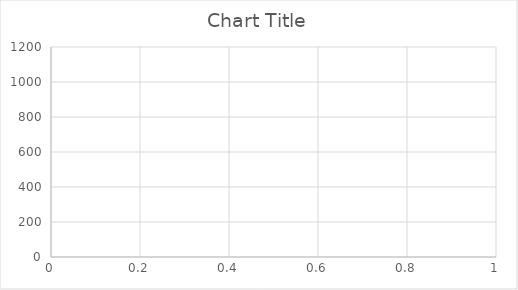
| Category | Series 0 |
|---|---|
| 0 | 1023 |
| 1 | 1023 |
| 2 | 1023 |
| 3 | 1023 |
| 4 | 1023 |
| 5 | 1023 |
| 6 | 1023 |
| 7 | 1023 |
| 8 | 1023 |
| 9 | 1023 |
| 10 | 1023 |
| 11 | 1023 |
| 12 | 1023 |
| 13 | 0 |
| 14 | 0 |
| 15 | 0 |
| 16 | 0 |
| 17 | 0 |
| 18 | 0 |
| 19 | 0 |
| 20 | 0 |
| 21 | 0 |
| 22 | 0 |
| 23 | 0 |
| 24 | 0 |
| 25 | 0 |
| 26 | 0 |
| 27 | 1023 |
| 28 | 1023 |
| 29 | 1023 |
| 30 | 1023 |
| 31 | 1023 |
| 32 | 1023 |
| 33 | 1023 |
| 34 | 1023 |
| 35 | 1023 |
| 36 | 1023 |
| 37 | 1023 |
| 38 | 1023 |
| 39 | 1023 |
| 40 | 1023 |
| 41 | 1023 |
| 42 | 1023 |
| 43 | 1023 |
| 44 | 1023 |
| 45 | 1023 |
| 46 | 1023 |
| 47 | 1023 |
| 48 | 1023 |
| 49 | 1023 |
| 50 | 1023 |
| 51 | 1023 |
| 52 | 1023 |
| 53 | 1023 |
| 54 | 1023 |
| 55 | 1023 |
| 56 | 1023 |
| 57 | 1023 |
| 58 | 1023 |
| 59 | 1023 |
| 60 | 1023 |
| 61 | 1023 |
| 62 | 1023 |
| 63 | 1023 |
| 64 | 1023 |
| 65 | 1023 |
| 66 | 1023 |
| 67 | 1023 |
| 68 | 0 |
| 69 | 0 |
| 70 | 0 |
| 71 | 0 |
| 72 | 0 |
| 73 | 0 |
| 74 | 0 |
| 75 | 0 |
| 76 | 1 |
| 77 | 0 |
| 78 | 0 |
| 79 | 0 |
| 80 | 0 |
| 81 | 0 |
| 82 | 0 |
| 83 | 1023 |
| 84 | 1023 |
| 85 | 1023 |
| 86 | 1023 |
| 87 | 1023 |
| 88 | 1023 |
| 89 | 1023 |
| 90 | 1023 |
| 91 | 1023 |
| 92 | 1023 |
| 93 | 1023 |
| 94 | 1023 |
| 95 | 1023 |
| 96 | 1023 |
| 97 | 1023 |
| 98 | 1023 |
| 99 | 1023 |
| 100 | 1023 |
| 101 | 1023 |
| 102 | 1023 |
| 103 | 1023 |
| 104 | 1023 |
| 105 | 1023 |
| 106 | 1023 |
| 107 | 1023 |
| 108 | 1023 |
| 109 | 1023 |
| 110 | 1023 |
| 111 | 1023 |
| 112 | 1023 |
| 113 | 1023 |
| 114 | 1023 |
| 115 | 1023 |
| 116 | 1023 |
| 117 | 1023 |
| 118 | 1023 |
| 119 | 1023 |
| 120 | 1023 |
| 121 | 1023 |
| 122 | 1023 |
| 123 | 1023 |
| 124 | 0 |
| 125 | 0 |
| 126 | 0 |
| 127 | 0 |
| 128 | 0 |
| 129 | 0 |
| 130 | 0 |
| 131 | 0 |
| 132 | 0 |
| 133 | 0 |
| 134 | 0 |
| 135 | 0 |
| 136 | 0 |
| 137 | 0 |
| 138 | 1023 |
| 139 | 1023 |
| 140 | 1023 |
| 141 | 1023 |
| 142 | 1023 |
| 143 | 1023 |
| 144 | 1023 |
| 145 | 1023 |
| 146 | 1023 |
| 147 | 1023 |
| 148 | 1023 |
| 149 | 1023 |
| 150 | 1023 |
| 151 | 1023 |
| 152 | 1023 |
| 153 | 1023 |
| 154 | 1023 |
| 155 | 1023 |
| 156 | 1023 |
| 157 | 1023 |
| 158 | 1023 |
| 159 | 1023 |
| 160 | 1023 |
| 161 | 1023 |
| 162 | 1023 |
| 163 | 1023 |
| 164 | 1023 |
| 165 | 1023 |
| 166 | 1023 |
| 167 | 1023 |
| 168 | 1023 |
| 169 | 1023 |
| 170 | 1023 |
| 171 | 1023 |
| 172 | 1023 |
| 173 | 1023 |
| 174 | 1023 |
| 175 | 1023 |
| 176 | 1023 |
| 177 | 0 |
| 178 | 0 |
| 179 | 0 |
| 180 | 0 |
| 181 | 0 |
| 182 | 0 |
| 183 | 0 |
| 184 | 0 |
| 185 | 0 |
| 186 | 0 |
| 187 | 0 |
| 188 | 0 |
| 189 | 0 |
| 190 | 1023 |
| 191 | 1023 |
| 192 | 1023 |
| 193 | 1023 |
| 194 | 1023 |
| 195 | 1023 |
| 196 | 1023 |
| 197 | 1023 |
| 198 | 1023 |
| 199 | 1023 |
| 200 | 1023 |
| 201 | 1023 |
| 202 | 1023 |
| 203 | 1023 |
| 204 | 1023 |
| 205 | 1023 |
| 206 | 1023 |
| 207 | 1023 |
| 208 | 1023 |
| 209 | 1023 |
| 210 | 1023 |
| 211 | 1023 |
| 212 | 1023 |
| 213 | 1023 |
| 214 | 1023 |
| 215 | 1023 |
| 216 | 1023 |
| 217 | 1023 |
| 218 | 1023 |
| 219 | 1023 |
| 220 | 1023 |
| 221 | 1023 |
| 222 | 1023 |
| 223 | 1023 |
| 224 | 1023 |
| 225 | 1023 |
| 226 | 1023 |
| 227 | 1023 |
| 228 | 0 |
| 229 | 0 |
| 230 | 0 |
| 231 | 0 |
| 232 | 0 |
| 233 | 0 |
| 234 | 0 |
| 235 | 0 |
| 236 | 0 |
| 237 | 0 |
| 238 | 0 |
| 239 | 0 |
| 240 | 0 |
| 241 | 1023 |
| 242 | 1023 |
| 243 | 1023 |
| 244 | 1023 |
| 245 | 1023 |
| 246 | 1023 |
| 247 | 1023 |
| 248 | 1023 |
| 249 | 1023 |
| 250 | 1023 |
| 251 | 1023 |
| 252 | 1023 |
| 253 | 1023 |
| 254 | 1023 |
| 255 | 1023 |
| 256 | 1023 |
| 257 | 1023 |
| 258 | 1023 |
| 259 | 1023 |
| 260 | 1023 |
| 261 | 1023 |
| 262 | 1023 |
| 263 | 1023 |
| 264 | 1023 |
| 265 | 1023 |
| 266 | 1023 |
| 267 | 1023 |
| 268 | 1023 |
| 269 | 1023 |
| 270 | 1023 |
| 271 | 1023 |
| 272 | 1023 |
| 273 | 1023 |
| 274 | 1023 |
| 275 | 1023 |
| 276 | 1023 |
| 277 | 1023 |
| 278 | 1023 |
| 279 | 0 |
| 280 | 0 |
| 281 | 0 |
| 282 | 0 |
| 283 | 0 |
| 284 | 0 |
| 285 | 0 |
| 286 | 0 |
| 287 | 0 |
| 288 | 0 |
| 289 | 0 |
| 290 | 0 |
| 291 | 0 |
| 292 | 1023 |
| 293 | 1023 |
| 294 | 1023 |
| 295 | 1023 |
| 296 | 1023 |
| 297 | 1023 |
| 298 | 1023 |
| 299 | 1023 |
| 300 | 1023 |
| 301 | 1023 |
| 302 | 1023 |
| 303 | 1023 |
| 304 | 1023 |
| 305 | 1023 |
| 306 | 1023 |
| 307 | 1023 |
| 308 | 1023 |
| 309 | 1023 |
| 310 | 1023 |
| 311 | 1023 |
| 312 | 1023 |
| 313 | 1023 |
| 314 | 1023 |
| 315 | 1023 |
| 316 | 1023 |
| 317 | 1023 |
| 318 | 1023 |
| 319 | 1023 |
| 320 | 1023 |
| 321 | 1023 |
| 322 | 1023 |
| 323 | 1023 |
| 324 | 1023 |
| 325 | 1023 |
| 326 | 1023 |
| 327 | 1023 |
| 328 | 1023 |
| 329 | 1023 |
| 330 | 0 |
| 331 | 0 |
| 332 | 0 |
| 333 | 0 |
| 334 | 0 |
| 335 | 0 |
| 336 | 0 |
| 337 | 0 |
| 338 | 0 |
| 339 | 0 |
| 340 | 0 |
| 341 | 0 |
| 342 | 0 |
| 343 | 1023 |
| 344 | 1023 |
| 345 | 1023 |
| 346 | 1023 |
| 347 | 1023 |
| 348 | 1023 |
| 349 | 1023 |
| 350 | 1023 |
| 351 | 1023 |
| 352 | 1023 |
| 353 | 1023 |
| 354 | 1023 |
| 355 | 1023 |
| 356 | 1023 |
| 357 | 1023 |
| 358 | 1023 |
| 359 | 1023 |
| 360 | 1023 |
| 361 | 1023 |
| 362 | 1023 |
| 363 | 1023 |
| 364 | 1023 |
| 365 | 1023 |
| 366 | 1023 |
| 367 | 1023 |
| 368 | 1023 |
| 369 | 1023 |
| 370 | 1023 |
| 371 | 1023 |
| 372 | 1023 |
| 373 | 1023 |
| 374 | 1023 |
| 375 | 1023 |
| 376 | 1023 |
| 377 | 1023 |
| 378 | 1023 |
| 379 | 1023 |
| 380 | 1023 |
| 381 | 0 |
| 382 | 0 |
| 383 | 0 |
| 384 | 0 |
| 385 | 0 |
| 386 | 0 |
| 387 | 0 |
| 388 | 0 |
| 389 | 0 |
| 390 | 0 |
| 391 | 0 |
| 392 | 0 |
| 393 | 0 |
| 394 | 1023 |
| 395 | 1023 |
| 396 | 1023 |
| 397 | 1023 |
| 398 | 1023 |
| 399 | 1023 |
| 400 | 1023 |
| 401 | 1023 |
| 402 | 1023 |
| 403 | 1023 |
| 404 | 1023 |
| 405 | 1023 |
| 406 | 1023 |
| 407 | 1023 |
| 408 | 1023 |
| 409 | 1023 |
| 410 | 1023 |
| 411 | 1023 |
| 412 | 1023 |
| 413 | 1023 |
| 414 | 1023 |
| 415 | 1023 |
| 416 | 1023 |
| 417 | 1023 |
| 418 | 1023 |
| 419 | 1023 |
| 420 | 1023 |
| 421 | 1023 |
| 422 | 1023 |
| 423 | 1023 |
| 424 | 1023 |
| 425 | 1023 |
| 426 | 1023 |
| 427 | 1023 |
| 428 | 1023 |
| 429 | 1023 |
| 430 | 1023 |
| 431 | 1023 |
| 432 | 0 |
| 433 | 0 |
| 434 | 0 |
| 435 | 0 |
| 436 | 0 |
| 437 | 0 |
| 438 | 0 |
| 439 | 0 |
| 440 | 0 |
| 441 | 0 |
| 442 | 0 |
| 443 | 0 |
| 444 | 0 |
| 445 | 0 |
| 446 | 1023 |
| 447 | 1023 |
| 448 | 1023 |
| 449 | 1023 |
| 450 | 1023 |
| 451 | 1023 |
| 452 | 1023 |
| 453 | 1023 |
| 454 | 1023 |
| 455 | 1023 |
| 456 | 1023 |
| 457 | 1023 |
| 458 | 1023 |
| 459 | 1023 |
| 460 | 1023 |
| 461 | 1023 |
| 462 | 1023 |
| 463 | 1023 |
| 464 | 1023 |
| 465 | 1023 |
| 466 | 1023 |
| 467 | 1023 |
| 468 | 1023 |
| 469 | 1023 |
| 470 | 1023 |
| 471 | 1023 |
| 472 | 1023 |
| 473 | 1023 |
| 474 | 1023 |
| 475 | 1023 |
| 476 | 1023 |
| 477 | 1023 |
| 478 | 1023 |
| 479 | 1023 |
| 480 | 1023 |
| 481 | 1023 |
| 482 | 1023 |
| 483 | 0 |
| 484 | 0 |
| 485 | 0 |
| 486 | 0 |
| 487 | 0 |
| 488 | 0 |
| 489 | 0 |
| 490 | 0 |
| 491 | 0 |
| 492 | 0 |
| 493 | 0 |
| 494 | 0 |
| 495 | 0 |
| 496 | 0 |
| 497 | 0 |
| 498 | 1023 |
| 499 | 1023 |
| 500 | 1023 |
| 501 | 1023 |
| 502 | 1023 |
| 503 | 1023 |
| 504 | 1023 |
| 505 | 1023 |
| 506 | 1023 |
| 507 | 1023 |
| 508 | 1023 |
| 509 | 1023 |
| 510 | 1023 |
| 511 | 1023 |
| 512 | 1023 |
| 513 | 1023 |
| 514 | 1023 |
| 515 | 1023 |
| 516 | 1023 |
| 517 | 1023 |
| 518 | 1023 |
| 519 | 1023 |
| 520 | 1023 |
| 521 | 1023 |
| 522 | 1023 |
| 523 | 1023 |
| 524 | 1023 |
| 525 | 1023 |
| 526 | 1023 |
| 527 | 1023 |
| 528 | 1023 |
| 529 | 1023 |
| 530 | 1023 |
| 531 | 1023 |
| 532 | 1023 |
| 533 | 1023 |
| 534 | 1023 |
| 535 | 0 |
| 536 | 0 |
| 537 | 0 |
| 538 | 0 |
| 539 | 0 |
| 540 | 0 |
| 541 | 0 |
| 542 | 0 |
| 543 | 0 |
| 544 | 0 |
| 545 | 0 |
| 546 | 0 |
| 547 | 0 |
| 548 | 0 |
| 549 | 1023 |
| 550 | 1023 |
| 551 | 1023 |
| 552 | 1023 |
| 553 | 1023 |
| 554 | 1023 |
| 555 | 1023 |
| 556 | 1023 |
| 557 | 1023 |
| 558 | 1023 |
| 559 | 1023 |
| 560 | 1023 |
| 561 | 1023 |
| 562 | 1023 |
| 563 | 1023 |
| 564 | 1023 |
| 565 | 1023 |
| 566 | 1023 |
| 567 | 1023 |
| 568 | 1023 |
| 569 | 1023 |
| 570 | 1023 |
| 571 | 1023 |
| 572 | 1023 |
| 573 | 1023 |
| 574 | 1023 |
| 575 | 1023 |
| 576 | 1023 |
| 577 | 1023 |
| 578 | 1023 |
| 579 | 1023 |
| 580 | 1023 |
| 581 | 1023 |
| 582 | 1023 |
| 583 | 1023 |
| 584 | 1023 |
| 585 | 1023 |
| 586 | 1023 |
| 587 | 0 |
| 588 | 0 |
| 589 | 0 |
| 590 | 0 |
| 591 | 0 |
| 592 | 0 |
| 593 | 1 |
| 594 | 0 |
| 595 | 0 |
| 596 | 0 |
| 597 | 0 |
| 598 | 0 |
| 599 | 0 |
| 600 | 0 |
| 601 | 1023 |
| 602 | 1023 |
| 603 | 1023 |
| 604 | 1023 |
| 605 | 1023 |
| 606 | 1023 |
| 607 | 1023 |
| 608 | 1023 |
| 609 | 1023 |
| 610 | 1023 |
| 611 | 1023 |
| 612 | 1023 |
| 613 | 1023 |
| 614 | 1023 |
| 615 | 1023 |
| 616 | 1023 |
| 617 | 1023 |
| 618 | 1023 |
| 619 | 1023 |
| 620 | 1023 |
| 621 | 1023 |
| 622 | 1023 |
| 623 | 1023 |
| 624 | 1023 |
| 625 | 1023 |
| 626 | 1023 |
| 627 | 1023 |
| 628 | 1023 |
| 629 | 1023 |
| 630 | 1023 |
| 631 | 1023 |
| 632 | 1023 |
| 633 | 1023 |
| 634 | 1023 |
| 635 | 1023 |
| 636 | 1023 |
| 637 | 1023 |
| 638 | 0 |
| 639 | 0 |
| 640 | 0 |
| 641 | 0 |
| 642 | 0 |
| 643 | 0 |
| 644 | 0 |
| 645 | 0 |
| 646 | 0 |
| 647 | 0 |
| 648 | 0 |
| 649 | 0 |
| 650 | 0 |
| 651 | 0 |
| 652 | 0 |
| 653 | 1023 |
| 654 | 1023 |
| 655 | 1023 |
| 656 | 1023 |
| 657 | 1023 |
| 658 | 1023 |
| 659 | 1023 |
| 660 | 1023 |
| 661 | 1023 |
| 662 | 1023 |
| 663 | 1023 |
| 664 | 1023 |
| 665 | 1023 |
| 666 | 1023 |
| 667 | 1023 |
| 668 | 1023 |
| 669 | 1023 |
| 670 | 1023 |
| 671 | 1023 |
| 672 | 1023 |
| 673 | 1023 |
| 674 | 1023 |
| 675 | 1023 |
| 676 | 1023 |
| 677 | 1023 |
| 678 | 1023 |
| 679 | 1023 |
| 680 | 1023 |
| 681 | 1023 |
| 682 | 1023 |
| 683 | 1023 |
| 684 | 1023 |
| 685 | 1023 |
| 686 | 1023 |
| 687 | 1023 |
| 688 | 1023 |
| 689 | 1023 |
| 690 | 0 |
| 691 | 0 |
| 692 | 0 |
| 693 | 0 |
| 694 | 0 |
| 695 | 0 |
| 696 | 0 |
| 697 | 0 |
| 698 | 0 |
| 699 | 0 |
| 700 | 0 |
| 701 | 0 |
| 702 | 0 |
| 703 | 0 |
| 704 | 0 |
| 705 | 1023 |
| 706 | 1023 |
| 707 | 1023 |
| 708 | 1023 |
| 709 | 1023 |
| 710 | 1023 |
| 711 | 1023 |
| 712 | 1023 |
| 713 | 1023 |
| 714 | 1023 |
| 715 | 1023 |
| 716 | 1023 |
| 717 | 1023 |
| 718 | 1023 |
| 719 | 1023 |
| 720 | 1023 |
| 721 | 1023 |
| 722 | 1023 |
| 723 | 1023 |
| 724 | 1023 |
| 725 | 1023 |
| 726 | 1023 |
| 727 | 1023 |
| 728 | 1023 |
| 729 | 1023 |
| 730 | 1023 |
| 731 | 1023 |
| 732 | 1023 |
| 733 | 1023 |
| 734 | 1023 |
| 735 | 1023 |
| 736 | 1023 |
| 737 | 1023 |
| 738 | 1023 |
| 739 | 1023 |
| 740 | 1023 |
| 741 | 1023 |
| 742 | 1023 |
| 743 | 0 |
| 744 | 0 |
| 745 | 0 |
| 746 | 0 |
| 747 | 0 |
| 748 | 0 |
| 749 | 0 |
| 750 | 0 |
| 751 | 0 |
| 752 | 0 |
| 753 | 0 |
| 754 | 0 |
| 755 | 0 |
| 756 | 1023 |
| 757 | 1023 |
| 758 | 1023 |
| 759 | 1023 |
| 760 | 1023 |
| 761 | 1023 |
| 762 | 1023 |
| 763 | 1023 |
| 764 | 1023 |
| 765 | 1023 |
| 766 | 1023 |
| 767 | 1023 |
| 768 | 1023 |
| 769 | 1023 |
| 770 | 1023 |
| 771 | 1023 |
| 772 | 1023 |
| 773 | 1023 |
| 774 | 1023 |
| 775 | 1023 |
| 776 | 1023 |
| 777 | 1023 |
| 778 | 1023 |
| 779 | 1023 |
| 780 | 1023 |
| 781 | 1023 |
| 782 | 1023 |
| 783 | 1023 |
| 784 | 1023 |
| 785 | 1023 |
| 786 | 1023 |
| 787 | 1023 |
| 788 | 1023 |
| 789 | 1023 |
| 790 | 1023 |
| 791 | 1023 |
| 792 | 1023 |
| 793 | 1023 |
| 794 | 0 |
| 795 | 0 |
| 796 | 0 |
| 797 | 0 |
| 798 | 0 |
| 799 | 0 |
| 800 | 0 |
| 801 | 0 |
| 802 | 0 |
| 803 | 0 |
| 804 | 0 |
| 805 | 0 |
| 806 | 0 |
| 807 | 1023 |
| 808 | 1023 |
| 809 | 1023 |
| 810 | 1023 |
| 811 | 1023 |
| 812 | 1023 |
| 813 | 1023 |
| 814 | 1023 |
| 815 | 1023 |
| 816 | 1023 |
| 817 | 1023 |
| 818 | 1023 |
| 819 | 1023 |
| 820 | 1023 |
| 821 | 1023 |
| 822 | 1023 |
| 823 | 1023 |
| 824 | 1023 |
| 825 | 1023 |
| 826 | 1023 |
| 827 | 1023 |
| 828 | 1023 |
| 829 | 1023 |
| 830 | 1023 |
| 831 | 1023 |
| 832 | 1023 |
| 833 | 1023 |
| 834 | 1023 |
| 835 | 1023 |
| 836 | 1023 |
| 837 | 1023 |
| 838 | 1023 |
| 839 | 1023 |
| 840 | 1023 |
| 841 | 1023 |
| 842 | 1023 |
| 843 | 1023 |
| 844 | 1023 |
| 845 | 0 |
| 846 | 0 |
| 847 | 0 |
| 848 | 0 |
| 849 | 0 |
| 850 | 0 |
| 851 | 0 |
| 852 | 0 |
| 853 | 0 |
| 854 | 0 |
| 855 | 0 |
| 856 | 0 |
| 857 | 0 |
| 858 | 1023 |
| 859 | 1023 |
| 860 | 1023 |
| 861 | 1023 |
| 862 | 1023 |
| 863 | 1023 |
| 864 | 1023 |
| 865 | 1023 |
| 866 | 1023 |
| 867 | 1023 |
| 868 | 1023 |
| 869 | 1023 |
| 870 | 1023 |
| 871 | 1023 |
| 872 | 1023 |
| 873 | 1023 |
| 874 | 1023 |
| 875 | 1023 |
| 876 | 1023 |
| 877 | 1023 |
| 878 | 1023 |
| 879 | 1023 |
| 880 | 1023 |
| 881 | 1023 |
| 882 | 1023 |
| 883 | 1023 |
| 884 | 1023 |
| 885 | 1023 |
| 886 | 1023 |
| 887 | 1023 |
| 888 | 1023 |
| 889 | 1023 |
| 890 | 1023 |
| 891 | 1023 |
| 892 | 1023 |
| 893 | 1023 |
| 894 | 1023 |
| 895 | 1023 |
| 896 | 0 |
| 897 | 0 |
| 898 | 0 |
| 899 | 0 |
| 900 | 0 |
| 901 | 0 |
| 902 | 0 |
| 903 | 0 |
| 904 | 0 |
| 905 | 0 |
| 906 | 0 |
| 907 | 0 |
| 908 | 0 |
| 909 | 1023 |
| 910 | 1023 |
| 911 | 1023 |
| 912 | 1023 |
| 913 | 1023 |
| 914 | 1023 |
| 915 | 1023 |
| 916 | 1023 |
| 917 | 1023 |
| 918 | 1023 |
| 919 | 1023 |
| 920 | 1023 |
| 921 | 1023 |
| 922 | 1023 |
| 923 | 1023 |
| 924 | 1023 |
| 925 | 1023 |
| 926 | 1023 |
| 927 | 1023 |
| 928 | 1023 |
| 929 | 1023 |
| 930 | 1023 |
| 931 | 1023 |
| 932 | 1023 |
| 933 | 1023 |
| 934 | 1023 |
| 935 | 1023 |
| 936 | 1023 |
| 937 | 1023 |
| 938 | 1023 |
| 939 | 1023 |
| 940 | 1023 |
| 941 | 1023 |
| 942 | 1023 |
| 943 | 1023 |
| 944 | 1023 |
| 945 | 1023 |
| 946 | 1023 |
| 947 | 0 |
| 948 | 0 |
| 949 | 0 |
| 950 | 0 |
| 951 | 0 |
| 952 | 0 |
| 953 | 0 |
| 954 | 0 |
| 955 | 0 |
| 956 | 0 |
| 957 | 0 |
| 958 | 0 |
| 959 | 0 |
| 960 | 1023 |
| 961 | 1023 |
| 962 | 1023 |
| 963 | 1023 |
| 964 | 1023 |
| 965 | 1023 |
| 966 | 1023 |
| 967 | 1023 |
| 968 | 1023 |
| 969 | 1023 |
| 970 | 1023 |
| 971 | 1023 |
| 972 | 1023 |
| 973 | 1023 |
| 974 | 1023 |
| 975 | 1023 |
| 976 | 1023 |
| 977 | 1023 |
| 978 | 1023 |
| 979 | 1023 |
| 980 | 1023 |
| 981 | 1023 |
| 982 | 1023 |
| 983 | 1023 |
| 984 | 1023 |
| 985 | 1023 |
| 986 | 1023 |
| 987 | 1023 |
| 988 | 1023 |
| 989 | 1023 |
| 990 | 1023 |
| 991 | 1023 |
| 992 | 1023 |
| 993 | 1023 |
| 994 | 1023 |
| 995 | 1023 |
| 996 | 1023 |
| 997 | 1023 |
| 998 | 0 |
| 999 | 0 |
| 1000 | 0 |
| 1001 | 0 |
| 1002 | 0 |
| 1003 | 0 |
| 1004 | 0 |
| 1005 | 0 |
| 1006 | 0 |
| 1007 | 0 |
| 1008 | 0 |
| 1009 | 0 |
| 1010 | 0 |
| 1011 | 0 |
| 1012 | 1023 |
| 1013 | 1023 |
| 1014 | 1023 |
| 1015 | 1023 |
| 1016 | 1023 |
| 1017 | 1023 |
| 1018 | 1023 |
| 1019 | 1023 |
| 1020 | 1023 |
| 1021 | 1023 |
| 1022 | 1023 |
| 1023 | 1023 |
| 1024 | 1023 |
| 1025 | 1023 |
| 1026 | 1023 |
| 1027 | 1023 |
| 1028 | 1023 |
| 1029 | 1023 |
| 1030 | 1023 |
| 1031 | 1023 |
| 1032 | 1023 |
| 1033 | 1023 |
| 1034 | 1023 |
| 1035 | 1023 |
| 1036 | 1023 |
| 1037 | 1023 |
| 1038 | 1023 |
| 1039 | 1023 |
| 1040 | 1023 |
| 1041 | 1023 |
| 1042 | 1023 |
| 1043 | 1023 |
| 1044 | 1023 |
| 1045 | 1023 |
| 1046 | 1023 |
| 1047 | 1023 |
| 1048 | 1023 |
| 1049 | 0 |
| 1050 | 0 |
| 1051 | 0 |
| 1052 | 0 |
| 1053 | 0 |
| 1054 | 0 |
| 1055 | 0 |
| 1056 | 0 |
| 1057 | 0 |
| 1058 | 0 |
| 1059 | 0 |
| 1060 | 0 |
| 1061 | 0 |
| 1062 | 0 |
| 1063 | 1023 |
| 1064 | 1023 |
| 1065 | 1023 |
| 1066 | 1023 |
| 1067 | 1023 |
| 1068 | 1023 |
| 1069 | 1023 |
| 1070 | 1023 |
| 1071 | 1023 |
| 1072 | 1023 |
| 1073 | 1023 |
| 1074 | 1023 |
| 1075 | 1023 |
| 1076 | 1023 |
| 1077 | 1023 |
| 1078 | 1023 |
| 1079 | 1023 |
| 1080 | 1023 |
| 1081 | 1023 |
| 1082 | 1023 |
| 1083 | 1023 |
| 1084 | 1023 |
| 1085 | 1023 |
| 1086 | 1023 |
| 1087 | 1023 |
| 1088 | 1023 |
| 1089 | 1023 |
| 1090 | 1023 |
| 1091 | 1023 |
| 1092 | 1023 |
| 1093 | 1023 |
| 1094 | 1023 |
| 1095 | 1023 |
| 1096 | 1023 |
| 1097 | 1023 |
| 1098 | 1023 |
| 1099 | 1023 |
| 1100 | 1023 |
| 1101 | 0 |
| 1102 | 0 |
| 1103 | 0 |
| 1104 | 0 |
| 1105 | 0 |
| 1106 | 0 |
| 1107 | 0 |
| 1108 | 0 |
| 1109 | 0 |
| 1110 | 0 |
| 1111 | 0 |
| 1112 | 0 |
| 1113 | 0 |
| 1114 | 0 |
| 1115 | 1023 |
| 1116 | 1023 |
| 1117 | 1023 |
| 1118 | 1023 |
| 1119 | 1023 |
| 1120 | 1023 |
| 1121 | 1023 |
| 1122 | 1023 |
| 1123 | 1023 |
| 1124 | 1023 |
| 1125 | 1023 |
| 1126 | 1023 |
| 1127 | 1023 |
| 1128 | 1023 |
| 1129 | 1023 |
| 1130 | 1023 |
| 1131 | 1023 |
| 1132 | 1023 |
| 1133 | 1023 |
| 1134 | 1023 |
| 1135 | 1023 |
| 1136 | 1023 |
| 1137 | 1023 |
| 1138 | 1023 |
| 1139 | 1023 |
| 1140 | 1023 |
| 1141 | 1023 |
| 1142 | 1023 |
| 1143 | 1023 |
| 1144 | 1023 |
| 1145 | 1023 |
| 1146 | 1023 |
| 1147 | 1023 |
| 1148 | 1023 |
| 1149 | 1023 |
| 1150 | 1023 |
| 1151 | 1023 |
| 1152 | 0 |
| 1153 | 0 |
| 1154 | 0 |
| 1155 | 0 |
| 1156 | 0 |
| 1157 | 0 |
| 1158 | 0 |
| 1159 | 0 |
| 1160 | 0 |
| 1161 | 0 |
| 1162 | 0 |
| 1163 | 0 |
| 1164 | 0 |
| 1165 | 0 |
| 1166 | 0 |
| 1167 | 1023 |
| 1168 | 1023 |
| 1169 | 1023 |
| 1170 | 1023 |
| 1171 | 1023 |
| 1172 | 1023 |
| 1173 | 1023 |
| 1174 | 1023 |
| 1175 | 1023 |
| 1176 | 1023 |
| 1177 | 1023 |
| 1178 | 1023 |
| 1179 | 1023 |
| 1180 | 1023 |
| 1181 | 1023 |
| 1182 | 1023 |
| 1183 | 1023 |
| 1184 | 1023 |
| 1185 | 1023 |
| 1186 | 1023 |
| 1187 | 1023 |
| 1188 | 1023 |
| 1189 | 1023 |
| 1190 | 1023 |
| 1191 | 1023 |
| 1192 | 1023 |
| 1193 | 1023 |
| 1194 | 1023 |
| 1195 | 1023 |
| 1196 | 1023 |
| 1197 | 1023 |
| 1198 | 1023 |
| 1199 | 1023 |
| 1200 | 1023 |
| 1201 | 1023 |
| 1202 | 1023 |
| 1203 | 1023 |
| 1204 | 0 |
| 1205 | 0 |
| 1206 | 0 |
| 1207 | 0 |
| 1208 | 0 |
| 1209 | 0 |
| 1210 | 0 |
| 1211 | 0 |
| 1212 | 0 |
| 1213 | 0 |
| 1214 | 0 |
| 1215 | 0 |
| 1216 | 0 |
| 1217 | 0 |
| 1218 | 0 |
| 1219 | 1023 |
| 1220 | 1023 |
| 1221 | 1023 |
| 1222 | 1023 |
| 1223 | 1023 |
| 1224 | 1023 |
| 1225 | 1023 |
| 1226 | 1023 |
| 1227 | 1023 |
| 1228 | 1023 |
| 1229 | 1023 |
| 1230 | 1023 |
| 1231 | 1023 |
| 1232 | 1023 |
| 1233 | 1023 |
| 1234 | 1023 |
| 1235 | 1023 |
| 1236 | 1023 |
| 1237 | 1023 |
| 1238 | 1023 |
| 1239 | 1023 |
| 1240 | 1023 |
| 1241 | 1023 |
| 1242 | 1023 |
| 1243 | 1023 |
| 1244 | 1023 |
| 1245 | 1023 |
| 1246 | 1023 |
| 1247 | 1023 |
| 1248 | 1023 |
| 1249 | 1023 |
| 1250 | 1023 |
| 1251 | 1023 |
| 1252 | 1023 |
| 1253 | 1023 |
| 1254 | 1023 |
| 1255 | 1023 |
| 1256 | 0 |
| 1257 | 0 |
| 1258 | 0 |
| 1259 | 0 |
| 1260 | 1 |
| 1261 | 0 |
| 1262 | 0 |
| 1263 | 0 |
| 1264 | 0 |
| 1265 | 0 |
| 1266 | 0 |
| 1267 | 0 |
| 1268 | 0 |
| 1269 | 0 |
| 1270 | 0 |
| 1271 | 1023 |
| 1272 | 1023 |
| 1273 | 1023 |
| 1274 | 1023 |
| 1275 | 1023 |
| 1276 | 1023 |
| 1277 | 1023 |
| 1278 | 1023 |
| 1279 | 1023 |
| 1280 | 1023 |
| 1281 | 1023 |
| 1282 | 1023 |
| 1283 | 1023 |
| 1284 | 1023 |
| 1285 | 1023 |
| 1286 | 1023 |
| 1287 | 1023 |
| 1288 | 1023 |
| 1289 | 1023 |
| 1290 | 1023 |
| 1291 | 1023 |
| 1292 | 1023 |
| 1293 | 1023 |
| 1294 | 1023 |
| 1295 | 1023 |
| 1296 | 1023 |
| 1297 | 1023 |
| 1298 | 1023 |
| 1299 | 1023 |
| 1300 | 1023 |
| 1301 | 1023 |
| 1302 | 1023 |
| 1303 | 1023 |
| 1304 | 1023 |
| 1305 | 1023 |
| 1306 | 1023 |
| 1307 | 1023 |
| 1308 | 1023 |
| 1309 | 0 |
| 1310 | 0 |
| 1311 | 0 |
| 1312 | 0 |
| 1313 | 0 |
| 1314 | 0 |
| 1315 | 0 |
| 1316 | 0 |
| 1317 | 0 |
| 1318 | 0 |
| 1319 | 0 |
| 1320 | 0 |
| 1321 | 0 |
| 1322 | 1023 |
| 1323 | 1023 |
| 1324 | 1023 |
| 1325 | 1023 |
| 1326 | 1023 |
| 1327 | 1023 |
| 1328 | 1023 |
| 1329 | 1023 |
| 1330 | 1023 |
| 1331 | 1023 |
| 1332 | 1023 |
| 1333 | 1023 |
| 1334 | 1023 |
| 1335 | 1023 |
| 1336 | 1023 |
| 1337 | 1023 |
| 1338 | 1023 |
| 1339 | 1023 |
| 1340 | 1023 |
| 1341 | 1023 |
| 1342 | 1023 |
| 1343 | 1023 |
| 1344 | 1023 |
| 1345 | 1023 |
| 1346 | 1023 |
| 1347 | 1023 |
| 1348 | 1023 |
| 1349 | 1023 |
| 1350 | 1023 |
| 1351 | 1023 |
| 1352 | 1023 |
| 1353 | 1023 |
| 1354 | 1023 |
| 1355 | 1023 |
| 1356 | 1023 |
| 1357 | 1023 |
| 1358 | 1023 |
| 1359 | 1023 |
| 1360 | 0 |
| 1361 | 0 |
| 1362 | 0 |
| 1363 | 0 |
| 1364 | 0 |
| 1365 | 0 |
| 1366 | 0 |
| 1367 | 0 |
| 1368 | 0 |
| 1369 | 0 |
| 1370 | 0 |
| 1371 | 0 |
| 1372 | 0 |
| 1373 | 1023 |
| 1374 | 1023 |
| 1375 | 1023 |
| 1376 | 1023 |
| 1377 | 1023 |
| 1378 | 1023 |
| 1379 | 1023 |
| 1380 | 1023 |
| 1381 | 1023 |
| 1382 | 1023 |
| 1383 | 1023 |
| 1384 | 1023 |
| 1385 | 1023 |
| 1386 | 1023 |
| 1387 | 1023 |
| 1388 | 1023 |
| 1389 | 1023 |
| 1390 | 1023 |
| 1391 | 1023 |
| 1392 | 1023 |
| 1393 | 1023 |
| 1394 | 1023 |
| 1395 | 1023 |
| 1396 | 1023 |
| 1397 | 1023 |
| 1398 | 1023 |
| 1399 | 1023 |
| 1400 | 1023 |
| 1401 | 1023 |
| 1402 | 1023 |
| 1403 | 1023 |
| 1404 | 1023 |
| 1405 | 1023 |
| 1406 | 1023 |
| 1407 | 1023 |
| 1408 | 1023 |
| 1409 | 1023 |
| 1410 | 1023 |
| 1411 | 0 |
| 1412 | 0 |
| 1413 | 0 |
| 1414 | 0 |
| 1415 | 0 |
| 1416 | 0 |
| 1417 | 0 |
| 1418 | 0 |
| 1419 | 0 |
| 1420 | 0 |
| 1421 | 0 |
| 1422 | 0 |
| 1423 | 0 |
| 1424 | 1023 |
| 1425 | 1023 |
| 1426 | 1023 |
| 1427 | 1023 |
| 1428 | 1023 |
| 1429 | 1023 |
| 1430 | 1023 |
| 1431 | 1023 |
| 1432 | 1023 |
| 1433 | 1023 |
| 1434 | 1023 |
| 1435 | 1023 |
| 1436 | 1023 |
| 1437 | 1023 |
| 1438 | 1023 |
| 1439 | 1023 |
| 1440 | 1023 |
| 1441 | 1023 |
| 1442 | 1023 |
| 1443 | 1023 |
| 1444 | 1023 |
| 1445 | 1023 |
| 1446 | 1023 |
| 1447 | 1023 |
| 1448 | 1023 |
| 1449 | 1023 |
| 1450 | 1023 |
| 1451 | 1023 |
| 1452 | 1023 |
| 1453 | 1023 |
| 1454 | 1023 |
| 1455 | 1023 |
| 1456 | 1023 |
| 1457 | 1023 |
| 1458 | 1023 |
| 1459 | 1023 |
| 1460 | 1023 |
| 1461 | 1023 |
| 1462 | 0 |
| 1463 | 0 |
| 1464 | 0 |
| 1465 | 0 |
| 1466 | 0 |
| 1467 | 0 |
| 1468 | 0 |
| 1469 | 0 |
| 1470 | 0 |
| 1471 | 0 |
| 1472 | 0 |
| 1473 | 0 |
| 1474 | 0 |
| 1475 | 1023 |
| 1476 | 1023 |
| 1477 | 1023 |
| 1478 | 1023 |
| 1479 | 1023 |
| 1480 | 1023 |
| 1481 | 1023 |
| 1482 | 1023 |
| 1483 | 1023 |
| 1484 | 1023 |
| 1485 | 1023 |
| 1486 | 1023 |
| 1487 | 1023 |
| 1488 | 1023 |
| 1489 | 1023 |
| 1490 | 1023 |
| 1491 | 1023 |
| 1492 | 1023 |
| 1493 | 1023 |
| 1494 | 1023 |
| 1495 | 1023 |
| 1496 | 1023 |
| 1497 | 1023 |
| 1498 | 1023 |
| 1499 | 1023 |
| 1500 | 1023 |
| 1501 | 1023 |
| 1502 | 1023 |
| 1503 | 1023 |
| 1504 | 1023 |
| 1505 | 1023 |
| 1506 | 1023 |
| 1507 | 1023 |
| 1508 | 1023 |
| 1509 | 1023 |
| 1510 | 1023 |
| 1511 | 1023 |
| 1512 | 1023 |
| 1513 | 0 |
| 1514 | 0 |
| 1515 | 0 |
| 1516 | 0 |
| 1517 | 0 |
| 1518 | 0 |
| 1519 | 0 |
| 1520 | 0 |
| 1521 | 0 |
| 1522 | 0 |
| 1523 | 0 |
| 1524 | 0 |
| 1525 | 0 |
| 1526 | 1023 |
| 1527 | 1023 |
| 1528 | 1023 |
| 1529 | 1023 |
| 1530 | 1023 |
| 1531 | 1023 |
| 1532 | 1023 |
| 1533 | 1023 |
| 1534 | 1023 |
| 1535 | 1023 |
| 1536 | 1023 |
| 1537 | 1023 |
| 1538 | 1023 |
| 1539 | 1023 |
| 1540 | 1023 |
| 1541 | 1023 |
| 1542 | 1023 |
| 1543 | 1023 |
| 1544 | 1023 |
| 1545 | 1023 |
| 1546 | 1023 |
| 1547 | 1023 |
| 1548 | 1023 |
| 1549 | 1023 |
| 1550 | 1023 |
| 1551 | 1023 |
| 1552 | 1023 |
| 1553 | 1023 |
| 1554 | 1023 |
| 1555 | 1023 |
| 1556 | 1023 |
| 1557 | 1023 |
| 1558 | 1023 |
| 1559 | 1023 |
| 1560 | 1023 |
| 1561 | 1023 |
| 1562 | 1023 |
| 1563 | 1023 |
| 1564 | 0 |
| 1565 | 0 |
| 1566 | 0 |
| 1567 | 0 |
| 1568 | 0 |
| 1569 | 0 |
| 1570 | 0 |
| 1571 | 0 |
| 1572 | 0 |
| 1573 | 0 |
| 1574 | 0 |
| 1575 | 0 |
| 1576 | 0 |
| 1577 | 1023 |
| 1578 | 1023 |
| 1579 | 1023 |
| 1580 | 1023 |
| 1581 | 1023 |
| 1582 | 1023 |
| 1583 | 1023 |
| 1584 | 1023 |
| 1585 | 1023 |
| 1586 | 1023 |
| 1587 | 1023 |
| 1588 | 1023 |
| 1589 | 1023 |
| 1590 | 1023 |
| 1591 | 1023 |
| 1592 | 1023 |
| 1593 | 1023 |
| 1594 | 1023 |
| 1595 | 1023 |
| 1596 | 1023 |
| 1597 | 1023 |
| 1598 | 1023 |
| 1599 | 1023 |
| 1600 | 1023 |
| 1601 | 1023 |
| 1602 | 1023 |
| 1603 | 1023 |
| 1604 | 1023 |
| 1605 | 1023 |
| 1606 | 1023 |
| 1607 | 1023 |
| 1608 | 1023 |
| 1609 | 1023 |
| 1610 | 1023 |
| 1611 | 1023 |
| 1612 | 1023 |
| 1613 | 1023 |
| 1614 | 1023 |
| 1615 | 0 |
| 1616 | 0 |
| 1617 | 0 |
| 1618 | 0 |
| 1619 | 0 |
| 1620 | 1 |
| 1621 | 0 |
| 1622 | 0 |
| 1623 | 0 |
| 1624 | 0 |
| 1625 | 0 |
| 1626 | 0 |
| 1627 | 0 |
| 1628 | 0 |
| 1629 | 1023 |
| 1630 | 1023 |
| 1631 | 1023 |
| 1632 | 1023 |
| 1633 | 1023 |
| 1634 | 1023 |
| 1635 | 1023 |
| 1636 | 1023 |
| 1637 | 1023 |
| 1638 | 1023 |
| 1639 | 1023 |
| 1640 | 1023 |
| 1641 | 1023 |
| 1642 | 1023 |
| 1643 | 1023 |
| 1644 | 1023 |
| 1645 | 1023 |
| 1646 | 1023 |
| 1647 | 1023 |
| 1648 | 1023 |
| 1649 | 1023 |
| 1650 | 1023 |
| 1651 | 1023 |
| 1652 | 1023 |
| 1653 | 1023 |
| 1654 | 1023 |
| 1655 | 1023 |
| 1656 | 1023 |
| 1657 | 1023 |
| 1658 | 1023 |
| 1659 | 1023 |
| 1660 | 1023 |
| 1661 | 1023 |
| 1662 | 1023 |
| 1663 | 1023 |
| 1664 | 1023 |
| 1665 | 1023 |
| 1666 | 0 |
| 1667 | 0 |
| 1668 | 0 |
| 1669 | 0 |
| 1670 | 0 |
| 1671 | 0 |
| 1672 | 0 |
| 1673 | 0 |
| 1674 | 0 |
| 1675 | 0 |
| 1676 | 0 |
| 1677 | 0 |
| 1678 | 0 |
| 1679 | 0 |
| 1680 | 809 |
| 1681 | 1023 |
| 1682 | 1023 |
| 1683 | 1023 |
| 1684 | 1023 |
| 1685 | 1023 |
| 1686 | 1023 |
| 1687 | 1023 |
| 1688 | 1023 |
| 1689 | 1023 |
| 1690 | 1023 |
| 1691 | 1023 |
| 1692 | 1023 |
| 1693 | 1023 |
| 1694 | 1023 |
| 1695 | 1023 |
| 1696 | 1023 |
| 1697 | 1023 |
| 1698 | 1023 |
| 1699 | 1023 |
| 1700 | 1023 |
| 1701 | 1023 |
| 1702 | 1023 |
| 1703 | 1023 |
| 1704 | 1023 |
| 1705 | 1023 |
| 1706 | 1023 |
| 1707 | 1023 |
| 1708 | 1023 |
| 1709 | 1023 |
| 1710 | 1023 |
| 1711 | 1023 |
| 1712 | 1023 |
| 1713 | 1023 |
| 1714 | 1023 |
| 1715 | 1023 |
| 1716 | 1023 |
| 1717 | 1023 |
| 1718 | 0 |
| 1719 | 0 |
| 1720 | 0 |
| 1721 | 0 |
| 1722 | 0 |
| 1723 | 0 |
| 1724 | 0 |
| 1725 | 0 |
| 1726 | 0 |
| 1727 | 0 |
| 1728 | 0 |
| 1729 | 0 |
| 1730 | 0 |
| 1731 | 0 |
| 1732 | 1023 |
| 1733 | 1023 |
| 1734 | 1023 |
| 1735 | 1023 |
| 1736 | 1023 |
| 1737 | 1023 |
| 1738 | 1023 |
| 1739 | 1023 |
| 1740 | 1023 |
| 1741 | 1023 |
| 1742 | 1023 |
| 1743 | 1023 |
| 1744 | 1023 |
| 1745 | 1023 |
| 1746 | 1023 |
| 1747 | 1023 |
| 1748 | 1023 |
| 1749 | 1023 |
| 1750 | 1023 |
| 1751 | 1023 |
| 1752 | 1023 |
| 1753 | 1023 |
| 1754 | 1023 |
| 1755 | 1023 |
| 1756 | 1023 |
| 1757 | 1023 |
| 1758 | 1023 |
| 1759 | 1023 |
| 1760 | 1023 |
| 1761 | 1023 |
| 1762 | 1023 |
| 1763 | 1023 |
| 1764 | 1023 |
| 1765 | 1023 |
| 1766 | 1023 |
| 1767 | 1023 |
| 1768 | 1023 |
| 1769 | 1023 |
| 1770 | 0 |
| 1771 | 0 |
| 1772 | 0 |
| 1773 | 0 |
| 1774 | 0 |
| 1775 | 0 |
| 1776 | 0 |
| 1777 | 0 |
| 1778 | 0 |
| 1779 | 0 |
| 1780 | 0 |
| 1781 | 0 |
| 1782 | 0 |
| 1783 | 1023 |
| 1784 | 1023 |
| 1785 | 1023 |
| 1786 | 1023 |
| 1787 | 1023 |
| 1788 | 1023 |
| 1789 | 1023 |
| 1790 | 1023 |
| 1791 | 1023 |
| 1792 | 1023 |
| 1793 | 1023 |
| 1794 | 1023 |
| 1795 | 1023 |
| 1796 | 1023 |
| 1797 | 1023 |
| 1798 | 1023 |
| 1799 | 1023 |
| 1800 | 1023 |
| 1801 | 1023 |
| 1802 | 1023 |
| 1803 | 1023 |
| 1804 | 1023 |
| 1805 | 1023 |
| 1806 | 1023 |
| 1807 | 1023 |
| 1808 | 1023 |
| 1809 | 1023 |
| 1810 | 1023 |
| 1811 | 1023 |
| 1812 | 1023 |
| 1813 | 1023 |
| 1814 | 1023 |
| 1815 | 1023 |
| 1816 | 1023 |
| 1817 | 1023 |
| 1818 | 1023 |
| 1819 | 1023 |
| 1820 | 1023 |
| 1821 | 0 |
| 1822 | 0 |
| 1823 | 0 |
| 1824 | 0 |
| 1825 | 0 |
| 1826 | 0 |
| 1827 | 0 |
| 1828 | 0 |
| 1829 | 0 |
| 1830 | 0 |
| 1831 | 0 |
| 1832 | 0 |
| 1833 | 1 |
| 1834 | 1023 |
| 1835 | 1023 |
| 1836 | 1023 |
| 1837 | 1023 |
| 1838 | 1023 |
| 1839 | 1023 |
| 1840 | 1023 |
| 1841 | 1023 |
| 1842 | 1023 |
| 1843 | 1023 |
| 1844 | 1023 |
| 1845 | 1023 |
| 1846 | 1023 |
| 1847 | 1023 |
| 1848 | 1023 |
| 1849 | 1023 |
| 1850 | 1023 |
| 1851 | 1023 |
| 1852 | 1023 |
| 1853 | 1023 |
| 1854 | 1023 |
| 1855 | 1023 |
| 1856 | 1023 |
| 1857 | 1023 |
| 1858 | 1023 |
| 1859 | 1023 |
| 1860 | 1023 |
| 1861 | 1023 |
| 1862 | 1023 |
| 1863 | 1023 |
| 1864 | 1023 |
| 1865 | 1023 |
| 1866 | 1023 |
| 1867 | 1023 |
| 1868 | 1023 |
| 1869 | 1023 |
| 1870 | 1023 |
| 1871 | 1023 |
| 1872 | 0 |
| 1873 | 0 |
| 1874 | 0 |
| 1875 | 0 |
| 1876 | 0 |
| 1877 | 0 |
| 1878 | 0 |
| 1879 | 0 |
| 1880 | 0 |
| 1881 | 0 |
| 1882 | 0 |
| 1883 | 0 |
| 1884 | 0 |
| 1885 | 1023 |
| 1886 | 1023 |
| 1887 | 1023 |
| 1888 | 1023 |
| 1889 | 1023 |
| 1890 | 1023 |
| 1891 | 1023 |
| 1892 | 1023 |
| 1893 | 1023 |
| 1894 | 1023 |
| 1895 | 1023 |
| 1896 | 1023 |
| 1897 | 1023 |
| 1898 | 1023 |
| 1899 | 1023 |
| 1900 | 1023 |
| 1901 | 1023 |
| 1902 | 1023 |
| 1903 | 1023 |
| 1904 | 1023 |
| 1905 | 1023 |
| 1906 | 1023 |
| 1907 | 1023 |
| 1908 | 1023 |
| 1909 | 1023 |
| 1910 | 1023 |
| 1911 | 1023 |
| 1912 | 1023 |
| 1913 | 1023 |
| 1914 | 1023 |
| 1915 | 1023 |
| 1916 | 1023 |
| 1917 | 1023 |
| 1918 | 1023 |
| 1919 | 1023 |
| 1920 | 1023 |
| 1921 | 1023 |
| 1922 | 1023 |
| 1923 | 0 |
| 1924 | 0 |
| 1925 | 0 |
| 1926 | 0 |
| 1927 | 0 |
| 1928 | 0 |
| 1929 | 0 |
| 1930 | 0 |
| 1931 | 0 |
| 1932 | 0 |
| 1933 | 0 |
| 1934 | 0 |
| 1935 | 0 |
| 1936 | 1023 |
| 1937 | 1023 |
| 1938 | 1023 |
| 1939 | 1023 |
| 1940 | 1023 |
| 1941 | 1023 |
| 1942 | 1023 |
| 1943 | 1023 |
| 1944 | 1023 |
| 1945 | 1023 |
| 1946 | 1023 |
| 1947 | 1023 |
| 1948 | 1023 |
| 1949 | 1023 |
| 1950 | 1023 |
| 1951 | 1023 |
| 1952 | 1023 |
| 1953 | 1023 |
| 1954 | 1023 |
| 1955 | 1023 |
| 1956 | 1023 |
| 1957 | 1023 |
| 1958 | 1023 |
| 1959 | 1023 |
| 1960 | 1023 |
| 1961 | 1023 |
| 1962 | 1023 |
| 1963 | 1023 |
| 1964 | 1023 |
| 1965 | 1023 |
| 1966 | 1023 |
| 1967 | 1023 |
| 1968 | 1023 |
| 1969 | 1023 |
| 1970 | 1023 |
| 1971 | 1023 |
| 1972 | 1023 |
| 1973 | 1023 |
| 1974 | 0 |
| 1975 | 0 |
| 1976 | 0 |
| 1977 | 0 |
| 1978 | 0 |
| 1979 | 0 |
| 1980 | 0 |
| 1981 | 0 |
| 1982 | 0 |
| 1983 | 0 |
| 1984 | 0 |
| 1985 | 0 |
| 1986 | 0 |
| 1987 | 1023 |
| 1988 | 1023 |
| 1989 | 1023 |
| 1990 | 1023 |
| 1991 | 1023 |
| 1992 | 1023 |
| 1993 | 1023 |
| 1994 | 1023 |
| 1995 | 1023 |
| 1996 | 1023 |
| 1997 | 1023 |
| 1998 | 1023 |
| 1999 | 1023 |
| 2000 | 1023 |
| 2001 | 1023 |
| 2002 | 1023 |
| 2003 | 1023 |
| 2004 | 1023 |
| 2005 | 1023 |
| 2006 | 1023 |
| 2007 | 1023 |
| 2008 | 1023 |
| 2009 | 1023 |
| 2010 | 1023 |
| 2011 | 1023 |
| 2012 | 1023 |
| 2013 | 1023 |
| 2014 | 1023 |
| 2015 | 1023 |
| 2016 | 1023 |
| 2017 | 1023 |
| 2018 | 1023 |
| 2019 | 1023 |
| 2020 | 1023 |
| 2021 | 1023 |
| 2022 | 1023 |
| 2023 | 1023 |
| 2024 | 1023 |
| 2025 | 0 |
| 2026 | 0 |
| 2027 | 0 |
| 2028 | 0 |
| 2029 | 0 |
| 2030 | 0 |
| 2031 | 0 |
| 2032 | 0 |
| 2033 | 0 |
| 2034 | 0 |
| 2035 | 0 |
| 2036 | 0 |
| 2037 | 0 |
| 2038 | 0 |
| 2039 | 1023 |
| 2040 | 1023 |
| 2041 | 1023 |
| 2042 | 1023 |
| 2043 | 1023 |
| 2044 | 1023 |
| 2045 | 1023 |
| 2046 | 1023 |
| 2047 | 1023 |
| 2048 | 1023 |
| 2049 | 1023 |
| 2050 | 1023 |
| 2051 | 1023 |
| 2052 | 1023 |
| 2053 | 1023 |
| 2054 | 1023 |
| 2055 | 1023 |
| 2056 | 1023 |
| 2057 | 1023 |
| 2058 | 1023 |
| 2059 | 1023 |
| 2060 | 1023 |
| 2061 | 1023 |
| 2062 | 1023 |
| 2063 | 1023 |
| 2064 | 1023 |
| 2065 | 1023 |
| 2066 | 1023 |
| 2067 | 1023 |
| 2068 | 1023 |
| 2069 | 1023 |
| 2070 | 1023 |
| 2071 | 1023 |
| 2072 | 1023 |
| 2073 | 1023 |
| 2074 | 1023 |
| 2075 | 1023 |
| 2076 | 0 |
| 2077 | 0 |
| 2078 | 0 |
| 2079 | 0 |
| 2080 | 0 |
| 2081 | 0 |
| 2082 | 0 |
| 2083 | 0 |
| 2084 | 0 |
| 2085 | 0 |
| 2086 | 0 |
| 2087 | 0 |
| 2088 | 0 |
| 2089 | 0 |
| 2090 | 1023 |
| 2091 | 1023 |
| 2092 | 1023 |
| 2093 | 1023 |
| 2094 | 1023 |
| 2095 | 1023 |
| 2096 | 1023 |
| 2097 | 1023 |
| 2098 | 1023 |
| 2099 | 1023 |
| 2100 | 1023 |
| 2101 | 1023 |
| 2102 | 1023 |
| 2103 | 1023 |
| 2104 | 1023 |
| 2105 | 1023 |
| 2106 | 1023 |
| 2107 | 1023 |
| 2108 | 1023 |
| 2109 | 1023 |
| 2110 | 1023 |
| 2111 | 1023 |
| 2112 | 1023 |
| 2113 | 1023 |
| 2114 | 1023 |
| 2115 | 1023 |
| 2116 | 1023 |
| 2117 | 1023 |
| 2118 | 1023 |
| 2119 | 1023 |
| 2120 | 1023 |
| 2121 | 1023 |
| 2122 | 1023 |
| 2123 | 1023 |
| 2124 | 1023 |
| 2125 | 1023 |
| 2126 | 1023 |
| 2127 | 1023 |
| 2128 | 0 |
| 2129 | 0 |
| 2130 | 0 |
| 2131 | 0 |
| 2132 | 0 |
| 2133 | 0 |
| 2134 | 0 |
| 2135 | 0 |
| 2136 | 0 |
| 2137 | 0 |
| 2138 | 0 |
| 2139 | 0 |
| 2140 | 0 |
| 2141 | 0 |
| 2142 | 1023 |
| 2143 | 1023 |
| 2144 | 1023 |
| 2145 | 1023 |
| 2146 | 1023 |
| 2147 | 1023 |
| 2148 | 1023 |
| 2149 | 1023 |
| 2150 | 1023 |
| 2151 | 1023 |
| 2152 | 1023 |
| 2153 | 1023 |
| 2154 | 1023 |
| 2155 | 1023 |
| 2156 | 1023 |
| 2157 | 1023 |
| 2158 | 1023 |
| 2159 | 1023 |
| 2160 | 1023 |
| 2161 | 1023 |
| 2162 | 1023 |
| 2163 | 1023 |
| 2164 | 1023 |
| 2165 | 1023 |
| 2166 | 1023 |
| 2167 | 1023 |
| 2168 | 1023 |
| 2169 | 1023 |
| 2170 | 1023 |
| 2171 | 1023 |
| 2172 | 1023 |
| 2173 | 1023 |
| 2174 | 1023 |
| 2175 | 1023 |
| 2176 | 1023 |
| 2177 | 1023 |
| 2178 | 1023 |
| 2179 | 0 |
| 2180 | 0 |
| 2181 | 0 |
| 2182 | 0 |
| 2183 | 0 |
| 2184 | 0 |
| 2185 | 0 |
| 2186 | 0 |
| 2187 | 0 |
| 2188 | 0 |
| 2189 | 0 |
| 2190 | 0 |
| 2191 | 0 |
| 2192 | 0 |
| 2193 | 0 |
| 2194 | 1023 |
| 2195 | 1023 |
| 2196 | 1023 |
| 2197 | 1023 |
| 2198 | 1023 |
| 2199 | 1023 |
| 2200 | 1023 |
| 2201 | 1023 |
| 2202 | 1023 |
| 2203 | 1023 |
| 2204 | 1023 |
| 2205 | 1023 |
| 2206 | 1023 |
| 2207 | 1023 |
| 2208 | 1023 |
| 2209 | 1023 |
| 2210 | 1023 |
| 2211 | 1023 |
| 2212 | 1023 |
| 2213 | 1023 |
| 2214 | 1023 |
| 2215 | 1023 |
| 2216 | 1023 |
| 2217 | 1023 |
| 2218 | 1023 |
| 2219 | 1023 |
| 2220 | 1023 |
| 2221 | 1023 |
| 2222 | 1023 |
| 2223 | 1023 |
| 2224 | 1023 |
| 2225 | 1023 |
| 2226 | 1023 |
| 2227 | 1023 |
| 2228 | 1023 |
| 2229 | 1023 |
| 2230 | 1023 |
| 2231 | 0 |
| 2232 | 0 |
| 2233 | 0 |
| 2234 | 0 |
| 2235 | 0 |
| 2236 | 0 |
| 2237 | 0 |
| 2238 | 0 |
| 2239 | 0 |
| 2240 | 0 |
| 2241 | 0 |
| 2242 | 0 |
| 2243 | 0 |
| 2244 | 0 |
| 2245 | 0 |
| 2246 | 1023 |
| 2247 | 1023 |
| 2248 | 1023 |
| 2249 | 1023 |
| 2250 | 1023 |
| 2251 | 1023 |
| 2252 | 1023 |
| 2253 | 1023 |
| 2254 | 1023 |
| 2255 | 1023 |
| 2256 | 1023 |
| 2257 | 1023 |
| 2258 | 1023 |
| 2259 | 1023 |
| 2260 | 1023 |
| 2261 | 1023 |
| 2262 | 1023 |
| 2263 | 1023 |
| 2264 | 1023 |
| 2265 | 1023 |
| 2266 | 1023 |
| 2267 | 1023 |
| 2268 | 1023 |
| 2269 | 1023 |
| 2270 | 1023 |
| 2271 | 1023 |
| 2272 | 1023 |
| 2273 | 1023 |
| 2274 | 1023 |
| 2275 | 1023 |
| 2276 | 1023 |
| 2277 | 1023 |
| 2278 | 1023 |
| 2279 | 1023 |
| 2280 | 1023 |
| 2281 | 1023 |
| 2282 | 1023 |
| 2283 | 0 |
| 2284 | 0 |
| 2285 | 0 |
| 2286 | 0 |
| 2287 | 0 |
| 2288 | 0 |
| 2289 | 0 |
| 2290 | 0 |
| 2291 | 0 |
| 2292 | 0 |
| 2293 | 0 |
| 2294 | 0 |
| 2295 | 0 |
| 2296 | 0 |
| 2297 | 0 |
| 2298 | 1023 |
| 2299 | 1023 |
| 2300 | 1023 |
| 2301 | 1023 |
| 2302 | 1023 |
| 2303 | 1023 |
| 2304 | 1023 |
| 2305 | 1023 |
| 2306 | 1023 |
| 2307 | 1023 |
| 2308 | 1023 |
| 2309 | 1023 |
| 2310 | 1023 |
| 2311 | 1023 |
| 2312 | 1023 |
| 2313 | 1023 |
| 2314 | 1023 |
| 2315 | 1023 |
| 2316 | 1023 |
| 2317 | 1023 |
| 2318 | 1023 |
| 2319 | 1023 |
| 2320 | 1023 |
| 2321 | 1023 |
| 2322 | 1023 |
| 2323 | 1023 |
| 2324 | 1023 |
| 2325 | 1023 |
| 2326 | 1023 |
| 2327 | 1023 |
| 2328 | 1023 |
| 2329 | 1023 |
| 2330 | 1023 |
| 2331 | 1023 |
| 2332 | 1023 |
| 2333 | 1023 |
| 2334 | 1023 |
| 2335 | 1023 |
| 2336 | 0 |
| 2337 | 0 |
| 2338 | 1 |
| 2339 | 1 |
| 2340 | 0 |
| 2341 | 0 |
| 2342 | 0 |
| 2343 | 0 |
| 2344 | 0 |
| 2345 | 0 |
| 2346 | 0 |
| 2347 | 0 |
| 2348 | 0 |
| 2349 | 1023 |
| 2350 | 1023 |
| 2351 | 1023 |
| 2352 | 1023 |
| 2353 | 1023 |
| 2354 | 1023 |
| 2355 | 1023 |
| 2356 | 1023 |
| 2357 | 1023 |
| 2358 | 1023 |
| 2359 | 1023 |
| 2360 | 1023 |
| 2361 | 1023 |
| 2362 | 1023 |
| 2363 | 1023 |
| 2364 | 1023 |
| 2365 | 1023 |
| 2366 | 1023 |
| 2367 | 1023 |
| 2368 | 1023 |
| 2369 | 1023 |
| 2370 | 1023 |
| 2371 | 1023 |
| 2372 | 1023 |
| 2373 | 1023 |
| 2374 | 1023 |
| 2375 | 1023 |
| 2376 | 1023 |
| 2377 | 1023 |
| 2378 | 1023 |
| 2379 | 1023 |
| 2380 | 1023 |
| 2381 | 1023 |
| 2382 | 1023 |
| 2383 | 1023 |
| 2384 | 1023 |
| 2385 | 1023 |
| 2386 | 1023 |
| 2387 | 0 |
| 2388 | 0 |
| 2389 | 0 |
| 2390 | 0 |
| 2391 | 0 |
| 2392 | 0 |
| 2393 | 0 |
| 2394 | 0 |
| 2395 | 0 |
| 2396 | 0 |
| 2397 | 0 |
| 2398 | 0 |
| 2399 | 0 |
| 2400 | 1023 |
| 2401 | 1023 |
| 2402 | 1023 |
| 2403 | 1023 |
| 2404 | 1023 |
| 2405 | 1023 |
| 2406 | 1023 |
| 2407 | 1023 |
| 2408 | 1023 |
| 2409 | 1023 |
| 2410 | 1023 |
| 2411 | 1023 |
| 2412 | 1023 |
| 2413 | 1023 |
| 2414 | 1023 |
| 2415 | 1023 |
| 2416 | 1023 |
| 2417 | 1023 |
| 2418 | 1023 |
| 2419 | 1023 |
| 2420 | 1023 |
| 2421 | 1023 |
| 2422 | 1023 |
| 2423 | 1023 |
| 2424 | 1023 |
| 2425 | 1023 |
| 2426 | 1023 |
| 2427 | 1023 |
| 2428 | 1023 |
| 2429 | 1023 |
| 2430 | 1023 |
| 2431 | 1023 |
| 2432 | 1023 |
| 2433 | 1023 |
| 2434 | 1023 |
| 2435 | 1023 |
| 2436 | 1023 |
| 2437 | 1023 |
| 2438 | 0 |
| 2439 | 0 |
| 2440 | 0 |
| 2441 | 0 |
| 2442 | 0 |
| 2443 | 0 |
| 2444 | 0 |
| 2445 | 0 |
| 2446 | 0 |
| 2447 | 0 |
| 2448 | 0 |
| 2449 | 0 |
| 2450 | 0 |
| 2451 | 1023 |
| 2452 | 1023 |
| 2453 | 1023 |
| 2454 | 1023 |
| 2455 | 1023 |
| 2456 | 1023 |
| 2457 | 1023 |
| 2458 | 1023 |
| 2459 | 1023 |
| 2460 | 1023 |
| 2461 | 1023 |
| 2462 | 1023 |
| 2463 | 1023 |
| 2464 | 1023 |
| 2465 | 1023 |
| 2466 | 1023 |
| 2467 | 1023 |
| 2468 | 1023 |
| 2469 | 1023 |
| 2470 | 1023 |
| 2471 | 1023 |
| 2472 | 1023 |
| 2473 | 1023 |
| 2474 | 1023 |
| 2475 | 1023 |
| 2476 | 1023 |
| 2477 | 1023 |
| 2478 | 1023 |
| 2479 | 1023 |
| 2480 | 1023 |
| 2481 | 1023 |
| 2482 | 1023 |
| 2483 | 1023 |
| 2484 | 1023 |
| 2485 | 1023 |
| 2486 | 1023 |
| 2487 | 1023 |
| 2488 | 1023 |
| 2489 | 0 |
| 2490 | 0 |
| 2491 | 0 |
| 2492 | 0 |
| 2493 | 0 |
| 2494 | 0 |
| 2495 | 0 |
| 2496 | 0 |
| 2497 | 0 |
| 2498 | 0 |
| 2499 | 0 |
| 2500 | 0 |
| 2501 | 0 |
| 2502 | 1023 |
| 2503 | 1023 |
| 2504 | 1023 |
| 2505 | 1023 |
| 2506 | 1023 |
| 2507 | 1023 |
| 2508 | 1023 |
| 2509 | 1023 |
| 2510 | 1023 |
| 2511 | 1023 |
| 2512 | 1023 |
| 2513 | 1023 |
| 2514 | 1023 |
| 2515 | 1023 |
| 2516 | 1023 |
| 2517 | 1023 |
| 2518 | 1023 |
| 2519 | 1023 |
| 2520 | 1023 |
| 2521 | 1023 |
| 2522 | 1023 |
| 2523 | 1023 |
| 2524 | 1023 |
| 2525 | 1023 |
| 2526 | 1023 |
| 2527 | 1023 |
| 2528 | 1023 |
| 2529 | 1023 |
| 2530 | 1023 |
| 2531 | 1023 |
| 2532 | 1023 |
| 2533 | 1023 |
| 2534 | 1023 |
| 2535 | 1023 |
| 2536 | 1023 |
| 2537 | 1023 |
| 2538 | 1023 |
| 2539 | 1023 |
| 2540 | 0 |
| 2541 | 0 |
| 2542 | 0 |
| 2543 | 0 |
| 2544 | 0 |
| 2545 | 0 |
| 2546 | 0 |
| 2547 | 0 |
| 2548 | 0 |
| 2549 | 0 |
| 2550 | 0 |
| 2551 | 0 |
| 2552 | 0 |
| 2553 | 1023 |
| 2554 | 1023 |
| 2555 | 1023 |
| 2556 | 1023 |
| 2557 | 1023 |
| 2558 | 1023 |
| 2559 | 1023 |
| 2560 | 1023 |
| 2561 | 1023 |
| 2562 | 1023 |
| 2563 | 1023 |
| 2564 | 1023 |
| 2565 | 1023 |
| 2566 | 1023 |
| 2567 | 1023 |
| 2568 | 1023 |
| 2569 | 1023 |
| 2570 | 1023 |
| 2571 | 1023 |
| 2572 | 1023 |
| 2573 | 1023 |
| 2574 | 1023 |
| 2575 | 1023 |
| 2576 | 1023 |
| 2577 | 1023 |
| 2578 | 1023 |
| 2579 | 1023 |
| 2580 | 1023 |
| 2581 | 1023 |
| 2582 | 1023 |
| 2583 | 1023 |
| 2584 | 1023 |
| 2585 | 1023 |
| 2586 | 1023 |
| 2587 | 1023 |
| 2588 | 1023 |
| 2589 | 1023 |
| 2590 | 1023 |
| 2591 | 0 |
| 2592 | 0 |
| 2593 | 0 |
| 2594 | 0 |
| 2595 | 0 |
| 2596 | 0 |
| 2597 | 0 |
| 2598 | 0 |
| 2599 | 0 |
| 2600 | 0 |
| 2601 | 0 |
| 2602 | 0 |
| 2603 | 0 |
| 2604 | 1023 |
| 2605 | 1023 |
| 2606 | 1023 |
| 2607 | 1023 |
| 2608 | 1023 |
| 2609 | 1023 |
| 2610 | 1023 |
| 2611 | 1023 |
| 2612 | 1023 |
| 2613 | 1023 |
| 2614 | 1023 |
| 2615 | 1023 |
| 2616 | 1023 |
| 2617 | 1023 |
| 2618 | 1023 |
| 2619 | 1023 |
| 2620 | 1023 |
| 2621 | 1023 |
| 2622 | 1023 |
| 2623 | 1023 |
| 2624 | 1023 |
| 2625 | 1023 |
| 2626 | 1023 |
| 2627 | 1023 |
| 2628 | 1023 |
| 2629 | 1023 |
| 2630 | 1023 |
| 2631 | 1023 |
| 2632 | 1023 |
| 2633 | 1023 |
| 2634 | 1023 |
| 2635 | 1023 |
| 2636 | 1023 |
| 2637 | 1023 |
| 2638 | 1023 |
| 2639 | 1023 |
| 2640 | 1023 |
| 2641 | 1023 |
| 2642 | 0 |
| 2643 | 0 |
| 2644 | 0 |
| 2645 | 0 |
| 2646 | 0 |
| 2647 | 0 |
| 2648 | 0 |
| 2649 | 0 |
| 2650 | 0 |
| 2651 | 0 |
| 2652 | 0 |
| 2653 | 0 |
| 2654 | 0 |
| 2655 | 0 |
| 2656 | 1023 |
| 2657 | 1023 |
| 2658 | 1023 |
| 2659 | 1023 |
| 2660 | 1023 |
| 2661 | 1023 |
| 2662 | 1023 |
| 2663 | 1023 |
| 2664 | 1023 |
| 2665 | 1023 |
| 2666 | 1023 |
| 2667 | 1023 |
| 2668 | 1023 |
| 2669 | 1023 |
| 2670 | 1023 |
| 2671 | 1023 |
| 2672 | 1023 |
| 2673 | 1023 |
| 2674 | 1023 |
| 2675 | 1023 |
| 2676 | 1023 |
| 2677 | 1023 |
| 2678 | 1023 |
| 2679 | 1023 |
| 2680 | 1023 |
| 2681 | 1023 |
| 2682 | 1023 |
| 2683 | 1023 |
| 2684 | 1023 |
| 2685 | 1023 |
| 2686 | 1023 |
| 2687 | 1023 |
| 2688 | 1023 |
| 2689 | 1023 |
| 2690 | 1023 |
| 2691 | 1023 |
| 2692 | 1023 |
| 2693 | 0 |
| 2694 | 0 |
| 2695 | 0 |
| 2696 | 0 |
| 2697 | 0 |
| 2698 | 0 |
| 2699 | 0 |
| 2700 | 0 |
| 2701 | 0 |
| 2702 | 0 |
| 2703 | 0 |
| 2704 | 0 |
| 2705 | 0 |
| 2706 | 1 |
| 2707 | 1023 |
| 2708 | 1023 |
| 2709 | 1023 |
| 2710 | 1023 |
| 2711 | 1023 |
| 2712 | 1023 |
| 2713 | 1023 |
| 2714 | 1023 |
| 2715 | 1023 |
| 2716 | 1023 |
| 2717 | 1023 |
| 2718 | 1023 |
| 2719 | 1023 |
| 2720 | 1023 |
| 2721 | 1023 |
| 2722 | 1023 |
| 2723 | 1023 |
| 2724 | 1023 |
| 2725 | 1023 |
| 2726 | 1023 |
| 2727 | 1023 |
| 2728 | 1023 |
| 2729 | 1023 |
| 2730 | 1023 |
| 2731 | 1023 |
| 2732 | 1023 |
| 2733 | 1023 |
| 2734 | 1023 |
| 2735 | 1023 |
| 2736 | 1023 |
| 2737 | 1023 |
| 2738 | 1023 |
| 2739 | 1023 |
| 2740 | 1023 |
| 2741 | 1023 |
| 2742 | 1023 |
| 2743 | 1023 |
| 2744 | 1023 |
| 2745 | 0 |
| 2746 | 0 |
| 2747 | 0 |
| 2748 | 0 |
| 2749 | 0 |
| 2750 | 0 |
| 2751 | 0 |
| 2752 | 0 |
| 2753 | 0 |
| 2754 | 0 |
| 2755 | 0 |
| 2756 | 0 |
| 2757 | 0 |
| 2758 | 0 |
| 2759 | 1023 |
| 2760 | 1023 |
| 2761 | 1023 |
| 2762 | 1023 |
| 2763 | 1023 |
| 2764 | 1023 |
| 2765 | 1023 |
| 2766 | 1023 |
| 2767 | 1023 |
| 2768 | 1023 |
| 2769 | 1023 |
| 2770 | 1023 |
| 2771 | 1023 |
| 2772 | 1023 |
| 2773 | 1023 |
| 2774 | 1023 |
| 2775 | 1023 |
| 2776 | 1023 |
| 2777 | 1023 |
| 2778 | 1023 |
| 2779 | 1023 |
| 2780 | 1023 |
| 2781 | 1023 |
| 2782 | 1023 |
| 2783 | 1023 |
| 2784 | 1023 |
| 2785 | 1023 |
| 2786 | 1023 |
| 2787 | 1023 |
| 2788 | 1023 |
| 2789 | 1023 |
| 2790 | 1023 |
| 2791 | 1023 |
| 2792 | 1023 |
| 2793 | 1023 |
| 2794 | 1023 |
| 2795 | 1023 |
| 2796 | 0 |
| 2797 | 0 |
| 2798 | 0 |
| 2799 | 0 |
| 2800 | 0 |
| 2801 | 0 |
| 2802 | 0 |
| 2803 | 0 |
| 2804 | 0 |
| 2805 | 0 |
| 2806 | 0 |
| 2807 | 0 |
| 2808 | 0 |
| 2809 | 0 |
| 2810 | 0 |
| 2811 | 1023 |
| 2812 | 1023 |
| 2813 | 1023 |
| 2814 | 1023 |
| 2815 | 1023 |
| 2816 | 1023 |
| 2817 | 1023 |
| 2818 | 1023 |
| 2819 | 1023 |
| 2820 | 1023 |
| 2821 | 1023 |
| 2822 | 1023 |
| 2823 | 1023 |
| 2824 | 1023 |
| 2825 | 1023 |
| 2826 | 1023 |
| 2827 | 1023 |
| 2828 | 1023 |
| 2829 | 1023 |
| 2830 | 1023 |
| 2831 | 1023 |
| 2832 | 1023 |
| 2833 | 1023 |
| 2834 | 1023 |
| 2835 | 1023 |
| 2836 | 1023 |
| 2837 | 1023 |
| 2838 | 1023 |
| 2839 | 1023 |
| 2840 | 1023 |
| 2841 | 1023 |
| 2842 | 1023 |
| 2843 | 1023 |
| 2844 | 1023 |
| 2845 | 1023 |
| 2846 | 1023 |
| 2847 | 1023 |
| 2848 | 0 |
| 2849 | 0 |
| 2850 | 0 |
| 2851 | 0 |
| 2852 | 0 |
| 2853 | 0 |
| 2854 | 0 |
| 2855 | 0 |
| 2856 | 0 |
| 2857 | 0 |
| 2858 | 0 |
| 2859 | 0 |
| 2860 | 0 |
| 2861 | 0 |
| 2862 | 0 |
| 2863 | 1023 |
| 2864 | 1023 |
| 2865 | 1023 |
| 2866 | 1023 |
| 2867 | 1023 |
| 2868 | 1023 |
| 2869 | 1023 |
| 2870 | 1023 |
| 2871 | 1023 |
| 2872 | 1023 |
| 2873 | 1023 |
| 2874 | 1023 |
| 2875 | 1023 |
| 2876 | 1023 |
| 2877 | 1023 |
| 2878 | 1023 |
| 2879 | 1023 |
| 2880 | 1023 |
| 2881 | 1023 |
| 2882 | 1023 |
| 2883 | 1023 |
| 2884 | 1023 |
| 2885 | 1023 |
| 2886 | 1023 |
| 2887 | 1023 |
| 2888 | 1023 |
| 2889 | 1023 |
| 2890 | 1023 |
| 2891 | 1023 |
| 2892 | 1023 |
| 2893 | 1023 |
| 2894 | 1023 |
| 2895 | 1023 |
| 2896 | 1023 |
| 2897 | 1023 |
| 2898 | 1023 |
| 2899 | 1023 |
| 2900 | 1023 |
| 2901 | 0 |
| 2902 | 0 |
| 2903 | 0 |
| 2904 | 0 |
| 2905 | 0 |
| 2906 | 0 |
| 2907 | 0 |
| 2908 | 0 |
| 2909 | 0 |
| 2910 | 0 |
| 2911 | 0 |
| 2912 | 0 |
| 2913 | 0 |
| 2914 | 1023 |
| 2915 | 1023 |
| 2916 | 1023 |
| 2917 | 1023 |
| 2918 | 1023 |
| 2919 | 1023 |
| 2920 | 1023 |
| 2921 | 1023 |
| 2922 | 1023 |
| 2923 | 1023 |
| 2924 | 1023 |
| 2925 | 1023 |
| 2926 | 1023 |
| 2927 | 1023 |
| 2928 | 1023 |
| 2929 | 1023 |
| 2930 | 1023 |
| 2931 | 1023 |
| 2932 | 1023 |
| 2933 | 1023 |
| 2934 | 1023 |
| 2935 | 1023 |
| 2936 | 1023 |
| 2937 | 1023 |
| 2938 | 1023 |
| 2939 | 1023 |
| 2940 | 1023 |
| 2941 | 1023 |
| 2942 | 1023 |
| 2943 | 1023 |
| 2944 | 1023 |
| 2945 | 1023 |
| 2946 | 1023 |
| 2947 | 1023 |
| 2948 | 1023 |
| 2949 | 1023 |
| 2950 | 1023 |
| 2951 | 1023 |
| 2952 | 0 |
| 2953 | 0 |
| 2954 | 0 |
| 2955 | 0 |
| 2956 | 0 |
| 2957 | 0 |
| 2958 | 0 |
| 2959 | 0 |
| 2960 | 0 |
| 2961 | 0 |
| 2962 | 0 |
| 2963 | 0 |
| 2964 | 0 |
| 2965 | 1023 |
| 2966 | 1023 |
| 2967 | 1023 |
| 2968 | 1023 |
| 2969 | 1023 |
| 2970 | 1023 |
| 2971 | 1023 |
| 2972 | 1023 |
| 2973 | 1023 |
| 2974 | 1023 |
| 2975 | 1023 |
| 2976 | 1023 |
| 2977 | 1023 |
| 2978 | 1023 |
| 2979 | 1023 |
| 2980 | 1023 |
| 2981 | 1023 |
| 2982 | 1023 |
| 2983 | 1023 |
| 2984 | 1023 |
| 2985 | 1023 |
| 2986 | 1023 |
| 2987 | 1023 |
| 2988 | 1023 |
| 2989 | 1023 |
| 2990 | 1023 |
| 2991 | 1023 |
| 2992 | 1023 |
| 2993 | 1023 |
| 2994 | 1023 |
| 2995 | 1023 |
| 2996 | 1023 |
| 2997 | 1023 |
| 2998 | 1023 |
| 2999 | 1023 |
| 3000 | 1023 |
| 3001 | 1023 |
| 3002 | 1023 |
| 3003 | 0 |
| 3004 | 0 |
| 3005 | 0 |
| 3006 | 0 |
| 3007 | 0 |
| 3008 | 0 |
| 3009 | 0 |
| 3010 | 0 |
| 3011 | 0 |
| 3012 | 0 |
| 3013 | 0 |
| 3014 | 0 |
| 3015 | 0 |
| 3016 | 1023 |
| 3017 | 1023 |
| 3018 | 1023 |
| 3019 | 1023 |
| 3020 | 1023 |
| 3021 | 1023 |
| 3022 | 1023 |
| 3023 | 1023 |
| 3024 | 1023 |
| 3025 | 1023 |
| 3026 | 1023 |
| 3027 | 1023 |
| 3028 | 1023 |
| 3029 | 1023 |
| 3030 | 1023 |
| 3031 | 1023 |
| 3032 | 1023 |
| 3033 | 1023 |
| 3034 | 1023 |
| 3035 | 1023 |
| 3036 | 1023 |
| 3037 | 1023 |
| 3038 | 1023 |
| 3039 | 1023 |
| 3040 | 1023 |
| 3041 | 1023 |
| 3042 | 1023 |
| 3043 | 1023 |
| 3044 | 1023 |
| 3045 | 1023 |
| 3046 | 1023 |
| 3047 | 1023 |
| 3048 | 1023 |
| 3049 | 1023 |
| 3050 | 1023 |
| 3051 | 1023 |
| 3052 | 1023 |
| 3053 | 1023 |
| 3054 | 0 |
| 3055 | 0 |
| 3056 | 0 |
| 3057 | 0 |
| 3058 | 0 |
| 3059 | 0 |
| 3060 | 0 |
| 3061 | 0 |
| 3062 | 0 |
| 3063 | 0 |
| 3064 | 0 |
| 3065 | 0 |
| 3066 | 0 |
| 3067 | 1023 |
| 3068 | 1023 |
| 3069 | 1023 |
| 3070 | 1023 |
| 3071 | 1023 |
| 3072 | 1023 |
| 3073 | 1023 |
| 3074 | 1023 |
| 3075 | 1023 |
| 3076 | 1023 |
| 3077 | 1023 |
| 3078 | 1023 |
| 3079 | 1023 |
| 3080 | 1023 |
| 3081 | 1023 |
| 3082 | 1023 |
| 3083 | 1023 |
| 3084 | 1023 |
| 3085 | 1023 |
| 3086 | 1023 |
| 3087 | 1023 |
| 3088 | 1023 |
| 3089 | 1023 |
| 3090 | 1023 |
| 3091 | 1023 |
| 3092 | 1023 |
| 3093 | 1023 |
| 3094 | 1023 |
| 3095 | 1023 |
| 3096 | 1023 |
| 3097 | 1023 |
| 3098 | 1023 |
| 3099 | 1023 |
| 3100 | 1023 |
| 3101 | 1023 |
| 3102 | 1023 |
| 3103 | 1023 |
| 3104 | 1023 |
| 3105 | 0 |
| 3106 | 0 |
| 3107 | 0 |
| 3108 | 0 |
| 3109 | 0 |
| 3110 | 0 |
| 3111 | 0 |
| 3112 | 0 |
| 3113 | 0 |
| 3114 | 0 |
| 3115 | 0 |
| 3116 | 0 |
| 3117 | 0 |
| 3118 | 1023 |
| 3119 | 1023 |
| 3120 | 1023 |
| 3121 | 1023 |
| 3122 | 1023 |
| 3123 | 1023 |
| 3124 | 1023 |
| 3125 | 1023 |
| 3126 | 1023 |
| 3127 | 1023 |
| 3128 | 1023 |
| 3129 | 1023 |
| 3130 | 1023 |
| 3131 | 1023 |
| 3132 | 1023 |
| 3133 | 1023 |
| 3134 | 1023 |
| 3135 | 1023 |
| 3136 | 1023 |
| 3137 | 1023 |
| 3138 | 1023 |
| 3139 | 1023 |
| 3140 | 1023 |
| 3141 | 1023 |
| 3142 | 1023 |
| 3143 | 1023 |
| 3144 | 1023 |
| 3145 | 1023 |
| 3146 | 1023 |
| 3147 | 1023 |
| 3148 | 1023 |
| 3149 | 1023 |
| 3150 | 1023 |
| 3151 | 1023 |
| 3152 | 1023 |
| 3153 | 1023 |
| 3154 | 1023 |
| 3155 | 1023 |
| 3156 | 0 |
| 3157 | 0 |
| 3158 | 0 |
| 3159 | 0 |
| 3160 | 0 |
| 3161 | 0 |
| 3162 | 0 |
| 3163 | 0 |
| 3164 | 0 |
| 3165 | 0 |
| 3166 | 0 |
| 3167 | 0 |
| 3168 | 0 |
| 3169 | 1023 |
| 3170 | 1023 |
| 3171 | 1023 |
| 3172 | 1023 |
| 3173 | 1023 |
| 3174 | 1023 |
| 3175 | 1023 |
| 3176 | 1023 |
| 3177 | 1023 |
| 3178 | 1023 |
| 3179 | 1023 |
| 3180 | 1023 |
| 3181 | 1023 |
| 3182 | 1023 |
| 3183 | 1023 |
| 3184 | 1023 |
| 3185 | 1023 |
| 3186 | 1023 |
| 3187 | 1023 |
| 3188 | 1023 |
| 3189 | 1023 |
| 3190 | 1023 |
| 3191 | 1023 |
| 3192 | 1023 |
| 3193 | 1023 |
| 3194 | 1023 |
| 3195 | 1023 |
| 3196 | 1023 |
| 3197 | 1023 |
| 3198 | 1023 |
| 3199 | 1023 |
| 3200 | 1023 |
| 3201 | 1023 |
| 3202 | 1023 |
| 3203 | 1023 |
| 3204 | 1023 |
| 3205 | 1023 |
| 3206 | 1023 |
| 3207 | 0 |
| 3208 | 0 |
| 3209 | 0 |
| 3210 | 0 |
| 3211 | 0 |
| 3212 | 0 |
| 3213 | 0 |
| 3214 | 0 |
| 3215 | 0 |
| 3216 | 0 |
| 3217 | 0 |
| 3218 | 0 |
| 3219 | 0 |
| 3220 | 1023 |
| 3221 | 1023 |
| 3222 | 1023 |
| 3223 | 1023 |
| 3224 | 1023 |
| 3225 | 1023 |
| 3226 | 1023 |
| 3227 | 1023 |
| 3228 | 1023 |
| 3229 | 1023 |
| 3230 | 1023 |
| 3231 | 1023 |
| 3232 | 1023 |
| 3233 | 1023 |
| 3234 | 1023 |
| 3235 | 1023 |
| 3236 | 1023 |
| 3237 | 1023 |
| 3238 | 1023 |
| 3239 | 1023 |
| 3240 | 1023 |
| 3241 | 1023 |
| 3242 | 1023 |
| 3243 | 1023 |
| 3244 | 1023 |
| 3245 | 1023 |
| 3246 | 1023 |
| 3247 | 1023 |
| 3248 | 1023 |
| 3249 | 1023 |
| 3250 | 1023 |
| 3251 | 1023 |
| 3252 | 1023 |
| 3253 | 1023 |
| 3254 | 1023 |
| 3255 | 1023 |
| 3256 | 1023 |
| 3257 | 1023 |
| 3258 | 0 |
| 3259 | 0 |
| 3260 | 0 |
| 3261 | 0 |
| 3262 | 0 |
| 3263 | 0 |
| 3264 | 0 |
| 3265 | 0 |
| 3266 | 0 |
| 3267 | 0 |
| 3268 | 0 |
| 3269 | 0 |
| 3270 | 0 |
| 3271 | 1023 |
| 3272 | 1023 |
| 3273 | 1023 |
| 3274 | 1023 |
| 3275 | 1023 |
| 3276 | 1023 |
| 3277 | 1023 |
| 3278 | 1023 |
| 3279 | 1023 |
| 3280 | 1023 |
| 3281 | 1023 |
| 3282 | 1023 |
| 3283 | 1023 |
| 3284 | 1023 |
| 3285 | 1023 |
| 3286 | 1023 |
| 3287 | 1023 |
| 3288 | 1023 |
| 3289 | 1023 |
| 3290 | 1023 |
| 3291 | 1023 |
| 3292 | 1023 |
| 3293 | 1023 |
| 3294 | 1023 |
| 3295 | 1023 |
| 3296 | 1023 |
| 3297 | 1023 |
| 3298 | 1023 |
| 3299 | 1023 |
| 3300 | 1023 |
| 3301 | 1023 |
| 3302 | 1023 |
| 3303 | 1023 |
| 3304 | 1023 |
| 3305 | 1023 |
| 3306 | 1023 |
| 3307 | 1023 |
| 3308 | 1023 |
| 3309 | 0 |
| 3310 | 0 |
| 3311 | 0 |
| 3312 | 0 |
| 3313 | 0 |
| 3314 | 0 |
| 3315 | 0 |
| 3316 | 0 |
| 3317 | 0 |
| 3318 | 0 |
| 3319 | 0 |
| 3320 | 0 |
| 3321 | 0 |
| 3322 | 0 |
| 3323 | 1023 |
| 3324 | 1023 |
| 3325 | 1023 |
| 3326 | 1023 |
| 3327 | 1023 |
| 3328 | 1023 |
| 3329 | 1023 |
| 3330 | 1023 |
| 3331 | 1023 |
| 3332 | 1023 |
| 3333 | 1023 |
| 3334 | 1023 |
| 3335 | 1023 |
| 3336 | 1023 |
| 3337 | 1023 |
| 3338 | 1023 |
| 3339 | 1023 |
| 3340 | 1023 |
| 3341 | 1023 |
| 3342 | 1023 |
| 3343 | 1023 |
| 3344 | 1023 |
| 3345 | 1023 |
| 3346 | 1023 |
| 3347 | 1023 |
| 3348 | 1023 |
| 3349 | 1023 |
| 3350 | 1023 |
| 3351 | 1023 |
| 3352 | 1023 |
| 3353 | 1023 |
| 3354 | 1023 |
| 3355 | 1023 |
| 3356 | 1023 |
| 3357 | 1023 |
| 3358 | 1023 |
| 3359 | 1023 |
| 3360 | 0 |
| 3361 | 0 |
| 3362 | 0 |
| 3363 | 0 |
| 3364 | 0 |
| 3365 | 0 |
| 3366 | 0 |
| 3367 | 0 |
| 3368 | 0 |
| 3369 | 0 |
| 3370 | 0 |
| 3371 | 0 |
| 3372 | 0 |
| 3373 | 0 |
| 3374 | 0 |
| 3375 | 1023 |
| 3376 | 1023 |
| 3377 | 1023 |
| 3378 | 1023 |
| 3379 | 1023 |
| 3380 | 1023 |
| 3381 | 1023 |
| 3382 | 1023 |
| 3383 | 1023 |
| 3384 | 1023 |
| 3385 | 1023 |
| 3386 | 1023 |
| 3387 | 1023 |
| 3388 | 1023 |
| 3389 | 1023 |
| 3390 | 1023 |
| 3391 | 1023 |
| 3392 | 1023 |
| 3393 | 1023 |
| 3394 | 1023 |
| 3395 | 1023 |
| 3396 | 1023 |
| 3397 | 1023 |
| 3398 | 1023 |
| 3399 | 1023 |
| 3400 | 1023 |
| 3401 | 1023 |
| 3402 | 1023 |
| 3403 | 1023 |
| 3404 | 1023 |
| 3405 | 1023 |
| 3406 | 1023 |
| 3407 | 1023 |
| 3408 | 1023 |
| 3409 | 1023 |
| 3410 | 1023 |
| 3411 | 1023 |
| 3412 | 0 |
| 3413 | 0 |
| 3414 | 0 |
| 3415 | 0 |
| 3416 | 0 |
| 3417 | 0 |
| 3418 | 0 |
| 3419 | 0 |
| 3420 | 0 |
| 3421 | 0 |
| 3422 | 0 |
| 3423 | 0 |
| 3424 | 0 |
| 3425 | 0 |
| 3426 | 0 |
| 3427 | 1023 |
| 3428 | 1023 |
| 3429 | 1023 |
| 3430 | 1023 |
| 3431 | 1023 |
| 3432 | 1023 |
| 3433 | 1023 |
| 3434 | 1023 |
| 3435 | 1023 |
| 3436 | 1023 |
| 3437 | 1023 |
| 3438 | 1023 |
| 3439 | 1023 |
| 3440 | 1023 |
| 3441 | 1023 |
| 3442 | 1023 |
| 3443 | 1023 |
| 3444 | 1023 |
| 3445 | 1023 |
| 3446 | 1023 |
| 3447 | 1023 |
| 3448 | 1023 |
| 3449 | 1023 |
| 3450 | 1023 |
| 3451 | 1023 |
| 3452 | 1023 |
| 3453 | 1023 |
| 3454 | 1023 |
| 3455 | 1023 |
| 3456 | 1023 |
| 3457 | 1023 |
| 3458 | 1023 |
| 3459 | 1023 |
| 3460 | 1023 |
| 3461 | 1023 |
| 3462 | 1023 |
| 3463 | 1023 |
| 3464 | 0 |
| 3465 | 0 |
| 3466 | 0 |
| 3467 | 0 |
| 3468 | 0 |
| 3469 | 0 |
| 3470 | 1 |
| 3471 | 0 |
| 3472 | 0 |
| 3473 | 0 |
| 3474 | 0 |
| 3475 | 0 |
| 3476 | 1 |
| 3477 | 0 |
| 3478 | 0 |
| 3479 | 1023 |
| 3480 | 1023 |
| 3481 | 1023 |
| 3482 | 1023 |
| 3483 | 1023 |
| 3484 | 1023 |
| 3485 | 1023 |
| 3486 | 1023 |
| 3487 | 1023 |
| 3488 | 1023 |
| 3489 | 1023 |
| 3490 | 1023 |
| 3491 | 1023 |
| 3492 | 1023 |
| 3493 | 1023 |
| 3494 | 1023 |
| 3495 | 1023 |
| 3496 | 1023 |
| 3497 | 1023 |
| 3498 | 1023 |
| 3499 | 1023 |
| 3500 | 1023 |
| 3501 | 1023 |
| 3502 | 1023 |
| 3503 | 1023 |
| 3504 | 1023 |
| 3505 | 1023 |
| 3506 | 1023 |
| 3507 | 1023 |
| 3508 | 1023 |
| 3509 | 1023 |
| 3510 | 1023 |
| 3511 | 1023 |
| 3512 | 1023 |
| 3513 | 1023 |
| 3514 | 1023 |
| 3515 | 1023 |
| 3516 | 1023 |
| 3517 | 0 |
| 3518 | 0 |
| 3519 | 0 |
| 3520 | 0 |
| 3521 | 0 |
| 3522 | 0 |
| 3523 | 0 |
| 3524 | 0 |
| 3525 | 0 |
| 3526 | 0 |
| 3527 | 1 |
| 3528 | 1 |
| 3529 | 0 |
| 3530 | 1023 |
| 3531 | 1023 |
| 3532 | 1023 |
| 3533 | 1023 |
| 3534 | 1023 |
| 3535 | 1023 |
| 3536 | 1023 |
| 3537 | 1023 |
| 3538 | 1023 |
| 3539 | 1023 |
| 3540 | 1023 |
| 3541 | 1023 |
| 3542 | 1023 |
| 3543 | 1023 |
| 3544 | 1023 |
| 3545 | 1023 |
| 3546 | 1023 |
| 3547 | 1023 |
| 3548 | 1023 |
| 3549 | 1023 |
| 3550 | 1023 |
| 3551 | 1023 |
| 3552 | 1023 |
| 3553 | 1023 |
| 3554 | 1023 |
| 3555 | 1023 |
| 3556 | 1023 |
| 3557 | 1023 |
| 3558 | 1023 |
| 3559 | 1023 |
| 3560 | 1023 |
| 3561 | 1023 |
| 3562 | 1023 |
| 3563 | 1023 |
| 3564 | 1023 |
| 3565 | 1023 |
| 3566 | 1023 |
| 3567 | 1023 |
| 3568 | 0 |
| 3569 | 0 |
| 3570 | 0 |
| 3571 | 0 |
| 3572 | 0 |
| 3573 | 0 |
| 3574 | 0 |
| 3575 | 0 |
| 3576 | 0 |
| 3577 | 0 |
| 3578 | 0 |
| 3579 | 0 |
| 3580 | 0 |
| 3581 | 1023 |
| 3582 | 1023 |
| 3583 | 1023 |
| 3584 | 1023 |
| 3585 | 1023 |
| 3586 | 1023 |
| 3587 | 1023 |
| 3588 | 1023 |
| 3589 | 1023 |
| 3590 | 1023 |
| 3591 | 1023 |
| 3592 | 1023 |
| 3593 | 1023 |
| 3594 | 1023 |
| 3595 | 1023 |
| 3596 | 1023 |
| 3597 | 1023 |
| 3598 | 1023 |
| 3599 | 1023 |
| 3600 | 1023 |
| 3601 | 1023 |
| 3602 | 1023 |
| 3603 | 1023 |
| 3604 | 1023 |
| 3605 | 1023 |
| 3606 | 1023 |
| 3607 | 1023 |
| 3608 | 1023 |
| 3609 | 1023 |
| 3610 | 1023 |
| 3611 | 1023 |
| 3612 | 1023 |
| 3613 | 1023 |
| 3614 | 1023 |
| 3615 | 1023 |
| 3616 | 1023 |
| 3617 | 1023 |
| 3618 | 1023 |
| 3619 | 0 |
| 3620 | 0 |
| 3621 | 0 |
| 3622 | 0 |
| 3623 | 0 |
| 3624 | 0 |
| 3625 | 0 |
| 3626 | 0 |
| 3627 | 0 |
| 3628 | 0 |
| 3629 | 0 |
| 3630 | 0 |
| 3631 | 0 |
| 3632 | 1023 |
| 3633 | 1023 |
| 3634 | 1023 |
| 3635 | 1023 |
| 3636 | 1023 |
| 3637 | 1023 |
| 3638 | 1023 |
| 3639 | 1023 |
| 3640 | 1023 |
| 3641 | 1023 |
| 3642 | 1023 |
| 3643 | 1023 |
| 3644 | 1023 |
| 3645 | 1023 |
| 3646 | 1023 |
| 3647 | 1023 |
| 3648 | 1023 |
| 3649 | 1023 |
| 3650 | 1023 |
| 3651 | 1023 |
| 3652 | 1023 |
| 3653 | 1023 |
| 3654 | 1023 |
| 3655 | 1023 |
| 3656 | 1023 |
| 3657 | 1023 |
| 3658 | 1023 |
| 3659 | 1023 |
| 3660 | 1023 |
| 3661 | 1023 |
| 3662 | 1023 |
| 3663 | 1023 |
| 3664 | 1023 |
| 3665 | 1023 |
| 3666 | 1023 |
| 3667 | 1023 |
| 3668 | 1023 |
| 3669 | 1023 |
| 3670 | 0 |
| 3671 | 0 |
| 3672 | 0 |
| 3673 | 0 |
| 3674 | 0 |
| 3675 | 0 |
| 3676 | 0 |
| 3677 | 0 |
| 3678 | 0 |
| 3679 | 0 |
| 3680 | 0 |
| 3681 | 0 |
| 3682 | 0 |
| 3683 | 1023 |
| 3684 | 1023 |
| 3685 | 1023 |
| 3686 | 1023 |
| 3687 | 1023 |
| 3688 | 1023 |
| 3689 | 1023 |
| 3690 | 1023 |
| 3691 | 1023 |
| 3692 | 1023 |
| 3693 | 1023 |
| 3694 | 1023 |
| 3695 | 1023 |
| 3696 | 1023 |
| 3697 | 1023 |
| 3698 | 1023 |
| 3699 | 1023 |
| 3700 | 1023 |
| 3701 | 1023 |
| 3702 | 1023 |
| 3703 | 1023 |
| 3704 | 1023 |
| 3705 | 1023 |
| 3706 | 1023 |
| 3707 | 1023 |
| 3708 | 1023 |
| 3709 | 1023 |
| 3710 | 1023 |
| 3711 | 1023 |
| 3712 | 1023 |
| 3713 | 1023 |
| 3714 | 1023 |
| 3715 | 1023 |
| 3716 | 1023 |
| 3717 | 1023 |
| 3718 | 1023 |
| 3719 | 1023 |
| 3720 | 1023 |
| 3721 | 0 |
| 3722 | 0 |
| 3723 | 0 |
| 3724 | 0 |
| 3725 | 0 |
| 3726 | 0 |
| 3727 | 0 |
| 3728 | 0 |
| 3729 | 0 |
| 3730 | 0 |
| 3731 | 0 |
| 3732 | 0 |
| 3733 | 0 |
| 3734 | 1023 |
| 3735 | 1023 |
| 3736 | 1023 |
| 3737 | 1023 |
| 3738 | 1023 |
| 3739 | 1023 |
| 3740 | 1023 |
| 3741 | 1023 |
| 3742 | 1023 |
| 3743 | 1023 |
| 3744 | 1023 |
| 3745 | 1023 |
| 3746 | 1023 |
| 3747 | 1023 |
| 3748 | 1023 |
| 3749 | 1023 |
| 3750 | 1023 |
| 3751 | 1023 |
| 3752 | 1023 |
| 3753 | 1023 |
| 3754 | 1023 |
| 3755 | 1023 |
| 3756 | 1023 |
| 3757 | 1023 |
| 3758 | 1023 |
| 3759 | 1023 |
| 3760 | 1023 |
| 3761 | 1023 |
| 3762 | 1023 |
| 3763 | 1023 |
| 3764 | 1023 |
| 3765 | 1023 |
| 3766 | 1023 |
| 3767 | 1023 |
| 3768 | 1023 |
| 3769 | 1023 |
| 3770 | 1023 |
| 3771 | 1023 |
| 3772 | 0 |
| 3773 | 0 |
| 3774 | 0 |
| 3775 | 0 |
| 3776 | 0 |
| 3777 | 0 |
| 3778 | 0 |
| 3779 | 0 |
| 3780 | 0 |
| 3781 | 0 |
| 3782 | 0 |
| 3783 | 0 |
| 3784 | 0 |
| 3785 | 1023 |
| 3786 | 1023 |
| 3787 | 1023 |
| 3788 | 1023 |
| 3789 | 1023 |
| 3790 | 1023 |
| 3791 | 1023 |
| 3792 | 1023 |
| 3793 | 1023 |
| 3794 | 1023 |
| 3795 | 1023 |
| 3796 | 1023 |
| 3797 | 1023 |
| 3798 | 1023 |
| 3799 | 1023 |
| 3800 | 1023 |
| 3801 | 1023 |
| 3802 | 1023 |
| 3803 | 1023 |
| 3804 | 1023 |
| 3805 | 1023 |
| 3806 | 1023 |
| 3807 | 1023 |
| 3808 | 1023 |
| 3809 | 1023 |
| 3810 | 1023 |
| 3811 | 1023 |
| 3812 | 1023 |
| 3813 | 1023 |
| 3814 | 1023 |
| 3815 | 1023 |
| 3816 | 1023 |
| 3817 | 1023 |
| 3818 | 1023 |
| 3819 | 1023 |
| 3820 | 1023 |
| 3821 | 1023 |
| 3822 | 1023 |
| 3823 | 0 |
| 3824 | 0 |
| 3825 | 0 |
| 3826 | 0 |
| 3827 | 0 |
| 3828 | 0 |
| 3829 | 0 |
| 3830 | 0 |
| 3831 | 0 |
| 3832 | 0 |
| 3833 | 0 |
| 3834 | 0 |
| 3835 | 0 |
| 3836 | 0 |
| 3837 | 1023 |
| 3838 | 1023 |
| 3839 | 1023 |
| 3840 | 1023 |
| 3841 | 1023 |
| 3842 | 1023 |
| 3843 | 1023 |
| 3844 | 1023 |
| 3845 | 1023 |
| 3846 | 1023 |
| 3847 | 1023 |
| 3848 | 1023 |
| 3849 | 1023 |
| 3850 | 1023 |
| 3851 | 1023 |
| 3852 | 1023 |
| 3853 | 1023 |
| 3854 | 1023 |
| 3855 | 1023 |
| 3856 | 1023 |
| 3857 | 1023 |
| 3858 | 1023 |
| 3859 | 1023 |
| 3860 | 1023 |
| 3861 | 1023 |
| 3862 | 1023 |
| 3863 | 1023 |
| 3864 | 1023 |
| 3865 | 1023 |
| 3866 | 1023 |
| 3867 | 1023 |
| 3868 | 1023 |
| 3869 | 1023 |
| 3870 | 1023 |
| 3871 | 1023 |
| 3872 | 1023 |
| 3873 | 1023 |
| 3874 | 0 |
| 3875 | 0 |
| 3876 | 0 |
| 3877 | 0 |
| 3878 | 0 |
| 3879 | 0 |
| 3880 | 0 |
| 3881 | 0 |
| 3882 | 0 |
| 3883 | 0 |
| 3884 | 0 |
| 3885 | 0 |
| 3886 | 0 |
| 3887 | 0 |
| 3888 | 1023 |
| 3889 | 1023 |
| 3890 | 1023 |
| 3891 | 1023 |
| 3892 | 1023 |
| 3893 | 1023 |
| 3894 | 1023 |
| 3895 | 1023 |
| 3896 | 1023 |
| 3897 | 1023 |
| 3898 | 1023 |
| 3899 | 1023 |
| 3900 | 1023 |
| 3901 | 1023 |
| 3902 | 1023 |
| 3903 | 1023 |
| 3904 | 1023 |
| 3905 | 1023 |
| 3906 | 1023 |
| 3907 | 1023 |
| 3908 | 1023 |
| 3909 | 1023 |
| 3910 | 1023 |
| 3911 | 1023 |
| 3912 | 1023 |
| 3913 | 1023 |
| 3914 | 1023 |
| 3915 | 1023 |
| 3916 | 1023 |
| 3917 | 1023 |
| 3918 | 1023 |
| 3919 | 1023 |
| 3920 | 1023 |
| 3921 | 1023 |
| 3922 | 1023 |
| 3923 | 1023 |
| 3924 | 1023 |
| 3925 | 1023 |
| 3926 | 0 |
| 3927 | 0 |
| 3928 | 0 |
| 3929 | 0 |
| 3930 | 0 |
| 3931 | 0 |
| 3932 | 0 |
| 3933 | 0 |
| 3934 | 0 |
| 3935 | 0 |
| 3936 | 0 |
| 3937 | 0 |
| 3938 | 0 |
| 3939 | 0 |
| 3940 | 1023 |
| 3941 | 1023 |
| 3942 | 1023 |
| 3943 | 1023 |
| 3944 | 1023 |
| 3945 | 1023 |
| 3946 | 1023 |
| 3947 | 1023 |
| 3948 | 1023 |
| 3949 | 1023 |
| 3950 | 1023 |
| 3951 | 1023 |
| 3952 | 1023 |
| 3953 | 1023 |
| 3954 | 1023 |
| 3955 | 1023 |
| 3956 | 1023 |
| 3957 | 1023 |
| 3958 | 1023 |
| 3959 | 1023 |
| 3960 | 1023 |
| 3961 | 1023 |
| 3962 | 1023 |
| 3963 | 1023 |
| 3964 | 1023 |
| 3965 | 1023 |
| 3966 | 1023 |
| 3967 | 1023 |
| 3968 | 1023 |
| 3969 | 1023 |
| 3970 | 1023 |
| 3971 | 1023 |
| 3972 | 1023 |
| 3973 | 1023 |
| 3974 | 1023 |
| 3975 | 1023 |
| 3976 | 1023 |
| 3977 | 0 |
| 3978 | 0 |
| 3979 | 0 |
| 3980 | 0 |
| 3981 | 0 |
| 3982 | 0 |
| 3983 | 0 |
| 3984 | 0 |
| 3985 | 0 |
| 3986 | 0 |
| 3987 | 0 |
| 3988 | 0 |
| 3989 | 0 |
| 3990 | 0 |
| 3991 | 1023 |
| 3992 | 1023 |
| 3993 | 1023 |
| 3994 | 1023 |
| 3995 | 1023 |
| 3996 | 1023 |
| 3997 | 1023 |
| 3998 | 1023 |
| 3999 | 1023 |
| 4000 | 1023 |
| 4001 | 1023 |
| 4002 | 1023 |
| 4003 | 1023 |
| 4004 | 1023 |
| 4005 | 1023 |
| 4006 | 1023 |
| 4007 | 1023 |
| 4008 | 1023 |
| 4009 | 1023 |
| 4010 | 1023 |
| 4011 | 1023 |
| 4012 | 1023 |
| 4013 | 1023 |
| 4014 | 1023 |
| 4015 | 1023 |
| 4016 | 1023 |
| 4017 | 1023 |
| 4018 | 1023 |
| 4019 | 1023 |
| 4020 | 1023 |
| 4021 | 1023 |
| 4022 | 1023 |
| 4023 | 1023 |
| 4024 | 1023 |
| 4025 | 1023 |
| 4026 | 1023 |
| 4027 | 1023 |
| 4028 | 1023 |
| 4029 | 0 |
| 4030 | 0 |
| 4031 | 0 |
| 4032 | 0 |
| 4033 | 0 |
| 4034 | 0 |
| 4035 | 0 |
| 4036 | 0 |
| 4037 | 0 |
| 4038 | 0 |
| 4039 | 0 |
| 4040 | 0 |
| 4041 | 0 |
| 4042 | 0 |
| 4043 | 1023 |
| 4044 | 1023 |
| 4045 | 1023 |
| 4046 | 1023 |
| 4047 | 1023 |
| 4048 | 1023 |
| 4049 | 1023 |
| 4050 | 1023 |
| 4051 | 1023 |
| 4052 | 1023 |
| 4053 | 1023 |
| 4054 | 1023 |
| 4055 | 1023 |
| 4056 | 1023 |
| 4057 | 1023 |
| 4058 | 1023 |
| 4059 | 1023 |
| 4060 | 1023 |
| 4061 | 1023 |
| 4062 | 1023 |
| 4063 | 1023 |
| 4064 | 1023 |
| 4065 | 1023 |
| 4066 | 1023 |
| 4067 | 1023 |
| 4068 | 1023 |
| 4069 | 1023 |
| 4070 | 1023 |
| 4071 | 1023 |
| 4072 | 1023 |
| 4073 | 1023 |
| 4074 | 1023 |
| 4075 | 1023 |
| 4076 | 1023 |
| 4077 | 1023 |
| 4078 | 1023 |
| 4079 | 1023 |
| 4080 | 0 |
| 4081 | 0 |
| 4082 | 0 |
| 4083 | 0 |
| 4084 | 0 |
| 4085 | 0 |
| 4086 | 0 |
| 4087 | 0 |
| 4088 | 0 |
| 4089 | 0 |
| 4090 | 0 |
| 4091 | 0 |
| 4092 | 0 |
| 4093 | 0 |
| 4094 | 0 |
| 4095 | 1023 |
| 4096 | 1023 |
| 4097 | 1023 |
| 4098 | 1023 |
| 4099 | 1023 |
| 4100 | 1023 |
| 4101 | 1023 |
| 4102 | 1023 |
| 4103 | 1023 |
| 4104 | 1023 |
| 4105 | 1023 |
| 4106 | 1023 |
| 4107 | 1023 |
| 4108 | 1023 |
| 4109 | 1023 |
| 4110 | 1023 |
| 4111 | 1023 |
| 4112 | 1023 |
| 4113 | 1023 |
| 4114 | 1023 |
| 4115 | 1023 |
| 4116 | 1023 |
| 4117 | 1023 |
| 4118 | 1023 |
| 4119 | 1023 |
| 4120 | 1023 |
| 4121 | 1023 |
| 4122 | 1023 |
| 4123 | 1023 |
| 4124 | 1023 |
| 4125 | 1023 |
| 4126 | 1023 |
| 4127 | 1023 |
| 4128 | 1023 |
| 4129 | 1023 |
| 4130 | 1023 |
| 4131 | 1023 |
| 4132 | 1023 |
| 4133 | 0 |
| 4134 | 0 |
| 4135 | 0 |
| 4136 | 0 |
| 4137 | 0 |
| 4138 | 0 |
| 4139 | 0 |
| 4140 | 1 |
| 4141 | 0 |
| 4142 | 1 |
| 4143 | 0 |
| 4144 | 0 |
| 4145 | 1 |
| 4146 | 1023 |
| 4147 | 1023 |
| 4148 | 1023 |
| 4149 | 1023 |
| 4150 | 1023 |
| 4151 | 1023 |
| 4152 | 1023 |
| 4153 | 1023 |
| 4154 | 1023 |
| 4155 | 1023 |
| 4156 | 1023 |
| 4157 | 1023 |
| 4158 | 1023 |
| 4159 | 1023 |
| 4160 | 1023 |
| 4161 | 1023 |
| 4162 | 1023 |
| 4163 | 1023 |
| 4164 | 1023 |
| 4165 | 1023 |
| 4166 | 1023 |
| 4167 | 1023 |
| 4168 | 1023 |
| 4169 | 1023 |
| 4170 | 1023 |
| 4171 | 1023 |
| 4172 | 1023 |
| 4173 | 1023 |
| 4174 | 1023 |
| 4175 | 1023 |
| 4176 | 1023 |
| 4177 | 1023 |
| 4178 | 1023 |
| 4179 | 1023 |
| 4180 | 1023 |
| 4181 | 1023 |
| 4182 | 1023 |
| 4183 | 1023 |
| 4184 | 0 |
| 4185 | 0 |
| 4186 | 0 |
| 4187 | 0 |
| 4188 | 0 |
| 4189 | 0 |
| 4190 | 0 |
| 4191 | 0 |
| 4192 | 0 |
| 4193 | 0 |
| 4194 | 0 |
| 4195 | 0 |
| 4196 | 0 |
| 4197 | 1023 |
| 4198 | 1023 |
| 4199 | 1023 |
| 4200 | 1023 |
| 4201 | 1023 |
| 4202 | 1023 |
| 4203 | 1023 |
| 4204 | 1023 |
| 4205 | 1023 |
| 4206 | 1023 |
| 4207 | 1023 |
| 4208 | 1023 |
| 4209 | 1023 |
| 4210 | 1023 |
| 4211 | 1023 |
| 4212 | 1023 |
| 4213 | 1023 |
| 4214 | 1023 |
| 4215 | 1023 |
| 4216 | 1023 |
| 4217 | 1023 |
| 4218 | 1023 |
| 4219 | 1023 |
| 4220 | 1023 |
| 4221 | 1023 |
| 4222 | 1023 |
| 4223 | 1023 |
| 4224 | 1023 |
| 4225 | 1023 |
| 4226 | 1023 |
| 4227 | 1023 |
| 4228 | 1023 |
| 4229 | 1023 |
| 4230 | 1023 |
| 4231 | 1023 |
| 4232 | 1023 |
| 4233 | 1023 |
| 4234 | 1023 |
| 4235 | 0 |
| 4236 | 0 |
| 4237 | 0 |
| 4238 | 0 |
| 4239 | 0 |
| 4240 | 0 |
| 4241 | 0 |
| 4242 | 0 |
| 4243 | 0 |
| 4244 | 0 |
| 4245 | 0 |
| 4246 | 0 |
| 4247 | 0 |
| 4248 | 1023 |
| 4249 | 1023 |
| 4250 | 1023 |
| 4251 | 1023 |
| 4252 | 1023 |
| 4253 | 1023 |
| 4254 | 1023 |
| 4255 | 1023 |
| 4256 | 1023 |
| 4257 | 1023 |
| 4258 | 1023 |
| 4259 | 1023 |
| 4260 | 1023 |
| 4261 | 1023 |
| 4262 | 1023 |
| 4263 | 1023 |
| 4264 | 1023 |
| 4265 | 1023 |
| 4266 | 1023 |
| 4267 | 1023 |
| 4268 | 1023 |
| 4269 | 1023 |
| 4270 | 1023 |
| 4271 | 1023 |
| 4272 | 1023 |
| 4273 | 1023 |
| 4274 | 1023 |
| 4275 | 1023 |
| 4276 | 1023 |
| 4277 | 1023 |
| 4278 | 1023 |
| 4279 | 1023 |
| 4280 | 1023 |
| 4281 | 1023 |
| 4282 | 1023 |
| 4283 | 1023 |
| 4284 | 1023 |
| 4285 | 1023 |
| 4286 | 0 |
| 4287 | 0 |
| 4288 | 0 |
| 4289 | 0 |
| 4290 | 0 |
| 4291 | 0 |
| 4292 | 0 |
| 4293 | 0 |
| 4294 | 0 |
| 4295 | 0 |
| 4296 | 0 |
| 4297 | 0 |
| 4298 | 0 |
| 4299 | 1023 |
| 4300 | 1023 |
| 4301 | 1023 |
| 4302 | 1023 |
| 4303 | 1023 |
| 4304 | 1023 |
| 4305 | 1023 |
| 4306 | 1023 |
| 4307 | 1023 |
| 4308 | 1023 |
| 4309 | 1023 |
| 4310 | 1023 |
| 4311 | 1023 |
| 4312 | 1023 |
| 4313 | 1023 |
| 4314 | 1023 |
| 4315 | 1023 |
| 4316 | 1023 |
| 4317 | 1023 |
| 4318 | 1023 |
| 4319 | 1023 |
| 4320 | 1023 |
| 4321 | 1023 |
| 4322 | 1023 |
| 4323 | 1023 |
| 4324 | 1023 |
| 4325 | 1023 |
| 4326 | 1023 |
| 4327 | 1023 |
| 4328 | 1023 |
| 4329 | 1023 |
| 4330 | 1023 |
| 4331 | 1023 |
| 4332 | 1023 |
| 4333 | 1023 |
| 4334 | 1023 |
| 4335 | 1023 |
| 4336 | 1023 |
| 4337 | 0 |
| 4338 | 0 |
| 4339 | 0 |
| 4340 | 0 |
| 4341 | 0 |
| 4342 | 0 |
| 4343 | 0 |
| 4344 | 0 |
| 4345 | 0 |
| 4346 | 0 |
| 4347 | 0 |
| 4348 | 0 |
| 4349 | 0 |
| 4350 | 1023 |
| 4351 | 1023 |
| 4352 | 1023 |
| 4353 | 1023 |
| 4354 | 1023 |
| 4355 | 1023 |
| 4356 | 1023 |
| 4357 | 1023 |
| 4358 | 1023 |
| 4359 | 1023 |
| 4360 | 1023 |
| 4361 | 1023 |
| 4362 | 1023 |
| 4363 | 1023 |
| 4364 | 1023 |
| 4365 | 1023 |
| 4366 | 1023 |
| 4367 | 1023 |
| 4368 | 1023 |
| 4369 | 1023 |
| 4370 | 1023 |
| 4371 | 1023 |
| 4372 | 1023 |
| 4373 | 1023 |
| 4374 | 1023 |
| 4375 | 1023 |
| 4376 | 1023 |
| 4377 | 1023 |
| 4378 | 1023 |
| 4379 | 1023 |
| 4380 | 1023 |
| 4381 | 1023 |
| 4382 | 1023 |
| 4383 | 1023 |
| 4384 | 1023 |
| 4385 | 1023 |
| 4386 | 1023 |
| 4387 | 1023 |
| 4388 | 0 |
| 4389 | 0 |
| 4390 | 0 |
| 4391 | 0 |
| 4392 | 0 |
| 4393 | 0 |
| 4394 | 0 |
| 4395 | 0 |
| 4396 | 0 |
| 4397 | 0 |
| 4398 | 0 |
| 4399 | 0 |
| 4400 | 0 |
| 4401 | 1023 |
| 4402 | 1023 |
| 4403 | 1023 |
| 4404 | 1023 |
| 4405 | 1023 |
| 4406 | 1023 |
| 4407 | 1023 |
| 4408 | 1023 |
| 4409 | 1023 |
| 4410 | 1023 |
| 4411 | 1023 |
| 4412 | 1023 |
| 4413 | 1023 |
| 4414 | 1023 |
| 4415 | 1023 |
| 4416 | 1023 |
| 4417 | 1023 |
| 4418 | 1023 |
| 4419 | 1023 |
| 4420 | 1023 |
| 4421 | 1023 |
| 4422 | 1023 |
| 4423 | 1023 |
| 4424 | 1023 |
| 4425 | 1023 |
| 4426 | 1023 |
| 4427 | 1023 |
| 4428 | 1023 |
| 4429 | 1023 |
| 4430 | 1023 |
| 4431 | 1023 |
| 4432 | 1023 |
| 4433 | 1023 |
| 4434 | 1023 |
| 4435 | 1023 |
| 4436 | 1023 |
| 4437 | 1023 |
| 4438 | 1023 |
| 4439 | 0 |
| 4440 | 0 |
| 4441 | 0 |
| 4442 | 0 |
| 4443 | 0 |
| 4444 | 0 |
| 4445 | 0 |
| 4446 | 0 |
| 4447 | 0 |
| 4448 | 0 |
| 4449 | 0 |
| 4450 | 0 |
| 4451 | 0 |
| 4452 | 0 |
| 4453 | 1023 |
| 4454 | 1023 |
| 4455 | 1023 |
| 4456 | 1023 |
| 4457 | 1023 |
| 4458 | 1023 |
| 4459 | 1023 |
| 4460 | 1023 |
| 4461 | 1023 |
| 4462 | 1023 |
| 4463 | 1023 |
| 4464 | 1023 |
| 4465 | 1023 |
| 4466 | 1023 |
| 4467 | 1023 |
| 4468 | 1023 |
| 4469 | 1023 |
| 4470 | 1023 |
| 4471 | 1023 |
| 4472 | 1023 |
| 4473 | 1023 |
| 4474 | 1023 |
| 4475 | 1023 |
| 4476 | 1023 |
| 4477 | 1023 |
| 4478 | 1023 |
| 4479 | 1023 |
| 4480 | 1023 |
| 4481 | 1023 |
| 4482 | 1023 |
| 4483 | 1023 |
| 4484 | 1023 |
| 4485 | 1023 |
| 4486 | 1023 |
| 4487 | 1023 |
| 4488 | 1023 |
| 4489 | 1023 |
| 4490 | 0 |
| 4491 | 0 |
| 4492 | 0 |
| 4493 | 0 |
| 4494 | 0 |
| 4495 | 0 |
| 4496 | 0 |
| 4497 | 0 |
| 4498 | 0 |
| 4499 | 0 |
| 4500 | 0 |
| 4501 | 0 |
| 4502 | 0 |
| 4503 | 0 |
| 4504 | 0 |
| 4505 | 1023 |
| 4506 | 1023 |
| 4507 | 1023 |
| 4508 | 1023 |
| 4509 | 1023 |
| 4510 | 1023 |
| 4511 | 1023 |
| 4512 | 1023 |
| 4513 | 1023 |
| 4514 | 1023 |
| 4515 | 1023 |
| 4516 | 1023 |
| 4517 | 1023 |
| 4518 | 1023 |
| 4519 | 1023 |
| 4520 | 1023 |
| 4521 | 1023 |
| 4522 | 1023 |
| 4523 | 1023 |
| 4524 | 1023 |
| 4525 | 1023 |
| 4526 | 1023 |
| 4527 | 1023 |
| 4528 | 1023 |
| 4529 | 1023 |
| 4530 | 1023 |
| 4531 | 1023 |
| 4532 | 1023 |
| 4533 | 1023 |
| 4534 | 1023 |
| 4535 | 1023 |
| 4536 | 1023 |
| 4537 | 1023 |
| 4538 | 1023 |
| 4539 | 1023 |
| 4540 | 1023 |
| 4541 | 1023 |
| 4542 | 0 |
| 4543 | 0 |
| 4544 | 0 |
| 4545 | 0 |
| 4546 | 0 |
| 4547 | 0 |
| 4548 | 0 |
| 4549 | 0 |
| 4550 | 0 |
| 4551 | 0 |
| 4552 | 0 |
| 4553 | 0 |
| 4554 | 0 |
| 4555 | 0 |
| 4556 | 0 |
| 4557 | 1023 |
| 4558 | 1023 |
| 4559 | 1023 |
| 4560 | 1023 |
| 4561 | 1023 |
| 4562 | 1023 |
| 4563 | 1023 |
| 4564 | 1023 |
| 4565 | 1023 |
| 4566 | 1023 |
| 4567 | 1023 |
| 4568 | 1023 |
| 4569 | 1023 |
| 4570 | 1023 |
| 4571 | 1023 |
| 4572 | 1023 |
| 4573 | 1023 |
| 4574 | 1023 |
| 4575 | 1023 |
| 4576 | 1023 |
| 4577 | 1023 |
| 4578 | 1023 |
| 4579 | 1023 |
| 4580 | 1023 |
| 4581 | 1023 |
| 4582 | 1023 |
| 4583 | 1023 |
| 4584 | 1023 |
| 4585 | 1023 |
| 4586 | 1023 |
| 4587 | 1023 |
| 4588 | 1023 |
| 4589 | 1023 |
| 4590 | 1023 |
| 4591 | 1023 |
| 4592 | 1023 |
| 4593 | 1023 |
| 4594 | 0 |
| 4595 | 0 |
| 4596 | 0 |
| 4597 | 0 |
| 4598 | 0 |
| 4599 | 0 |
| 4600 | 0 |
| 4601 | 0 |
| 4602 | 0 |
| 4603 | 0 |
| 4604 | 0 |
| 4605 | 0 |
| 4606 | 0 |
| 4607 | 0 |
| 4608 | 0 |
| 4609 | 1023 |
| 4610 | 1023 |
| 4611 | 1023 |
| 4612 | 1023 |
| 4613 | 1023 |
| 4614 | 1023 |
| 4615 | 1023 |
| 4616 | 1023 |
| 4617 | 1023 |
| 4618 | 1023 |
| 4619 | 1023 |
| 4620 | 1023 |
| 4621 | 1023 |
| 4622 | 1023 |
| 4623 | 1023 |
| 4624 | 1023 |
| 4625 | 1023 |
| 4626 | 1023 |
| 4627 | 1023 |
| 4628 | 1023 |
| 4629 | 1023 |
| 4630 | 1023 |
| 4631 | 1023 |
| 4632 | 1023 |
| 4633 | 1023 |
| 4634 | 1023 |
| 4635 | 1023 |
| 4636 | 1023 |
| 4637 | 1023 |
| 4638 | 1023 |
| 4639 | 1023 |
| 4640 | 1023 |
| 4641 | 1023 |
| 4642 | 1023 |
| 4643 | 1023 |
| 4644 | 1023 |
| 4645 | 1023 |
| 4646 | 0 |
| 4647 | 0 |
| 4648 | 0 |
| 4649 | 0 |
| 4650 | 0 |
| 4651 | 0 |
| 4652 | 0 |
| 4653 | 0 |
| 4654 | 0 |
| 4655 | 0 |
| 4656 | 0 |
| 4657 | 0 |
| 4658 | 0 |
| 4659 | 0 |
| 4660 | 0 |
| 4661 | 1023 |
| 4662 | 1023 |
| 4663 | 1023 |
| 4664 | 1023 |
| 4665 | 1023 |
| 4666 | 1023 |
| 4667 | 1023 |
| 4668 | 1023 |
| 4669 | 1023 |
| 4670 | 1023 |
| 4671 | 1023 |
| 4672 | 1023 |
| 4673 | 1023 |
| 4674 | 1023 |
| 4675 | 1023 |
| 4676 | 1023 |
| 4677 | 1023 |
| 4678 | 1023 |
| 4679 | 1023 |
| 4680 | 1023 |
| 4681 | 1023 |
| 4682 | 1023 |
| 4683 | 1023 |
| 4684 | 1023 |
| 4685 | 1023 |
| 4686 | 1023 |
| 4687 | 1023 |
| 4688 | 1023 |
| 4689 | 1023 |
| 4690 | 1023 |
| 4691 | 1023 |
| 4692 | 1023 |
| 4693 | 1023 |
| 4694 | 1023 |
| 4695 | 1023 |
| 4696 | 1023 |
| 4697 | 1023 |
| 4698 | 0 |
| 4699 | 0 |
| 4700 | 0 |
| 4701 | 0 |
| 4702 | 0 |
| 4703 | 0 |
| 4704 | 0 |
| 4705 | 0 |
| 4706 | 0 |
| 4707 | 0 |
| 4708 | 0 |
| 4709 | 0 |
| 4710 | 0 |
| 4711 | 0 |
| 4712 | 0 |
| 4713 | 1023 |
| 4714 | 1023 |
| 4715 | 1023 |
| 4716 | 1023 |
| 4717 | 1023 |
| 4718 | 1023 |
| 4719 | 1023 |
| 4720 | 1023 |
| 4721 | 1023 |
| 4722 | 1023 |
| 4723 | 1023 |
| 4724 | 1023 |
| 4725 | 1023 |
| 4726 | 1023 |
| 4727 | 1023 |
| 4728 | 1023 |
| 4729 | 1023 |
| 4730 | 1023 |
| 4731 | 1023 |
| 4732 | 1023 |
| 4733 | 1023 |
| 4734 | 1023 |
| 4735 | 1023 |
| 4736 | 1023 |
| 4737 | 1023 |
| 4738 | 1023 |
| 4739 | 1023 |
| 4740 | 1023 |
| 4741 | 1023 |
| 4742 | 1023 |
| 4743 | 1023 |
| 4744 | 1023 |
| 4745 | 1023 |
| 4746 | 1023 |
| 4747 | 1023 |
| 4748 | 1023 |
| 4749 | 1023 |
| 4750 | 1023 |
| 4751 | 0 |
| 4752 | 0 |
| 4753 | 0 |
| 4754 | 0 |
| 4755 | 0 |
| 4756 | 0 |
| 4757 | 0 |
| 4758 | 0 |
| 4759 | 0 |
| 4760 | 0 |
| 4761 | 0 |
| 4762 | 0 |
| 4763 | 0 |
| 4764 | 1023 |
| 4765 | 1023 |
| 4766 | 1023 |
| 4767 | 1023 |
| 4768 | 1023 |
| 4769 | 1023 |
| 4770 | 1023 |
| 4771 | 1023 |
| 4772 | 1023 |
| 4773 | 1023 |
| 4774 | 1023 |
| 4775 | 1023 |
| 4776 | 1023 |
| 4777 | 1023 |
| 4778 | 1023 |
| 4779 | 1023 |
| 4780 | 1023 |
| 4781 | 1023 |
| 4782 | 1023 |
| 4783 | 1023 |
| 4784 | 1023 |
| 4785 | 1023 |
| 4786 | 1023 |
| 4787 | 1023 |
| 4788 | 1023 |
| 4789 | 1023 |
| 4790 | 1023 |
| 4791 | 1023 |
| 4792 | 1023 |
| 4793 | 1023 |
| 4794 | 1023 |
| 4795 | 1023 |
| 4796 | 1023 |
| 4797 | 1023 |
| 4798 | 1023 |
| 4799 | 1023 |
| 4800 | 1023 |
| 4801 | 1023 |
| 4802 | 0 |
| 4803 | 0 |
| 4804 | 0 |
| 4805 | 0 |
| 4806 | 0 |
| 4807 | 0 |
| 4808 | 0 |
| 4809 | 0 |
| 4810 | 0 |
| 4811 | 0 |
| 4812 | 0 |
| 4813 | 0 |
| 4814 | 0 |
| 4815 | 1023 |
| 4816 | 1023 |
| 4817 | 1023 |
| 4818 | 1023 |
| 4819 | 1023 |
| 4820 | 1023 |
| 4821 | 1023 |
| 4822 | 1023 |
| 4823 | 1023 |
| 4824 | 1023 |
| 4825 | 1023 |
| 4826 | 1023 |
| 4827 | 1023 |
| 4828 | 1023 |
| 4829 | 1023 |
| 4830 | 1023 |
| 4831 | 1023 |
| 4832 | 1023 |
| 4833 | 1023 |
| 4834 | 1023 |
| 4835 | 1023 |
| 4836 | 1023 |
| 4837 | 1023 |
| 4838 | 1023 |
| 4839 | 1023 |
| 4840 | 1023 |
| 4841 | 1023 |
| 4842 | 1023 |
| 4843 | 1023 |
| 4844 | 1023 |
| 4845 | 1023 |
| 4846 | 1023 |
| 4847 | 1023 |
| 4848 | 1023 |
| 4849 | 1023 |
| 4850 | 1023 |
| 4851 | 1023 |
| 4852 | 1023 |
| 4853 | 0 |
| 4854 | 0 |
| 4855 | 0 |
| 4856 | 0 |
| 4857 | 0 |
| 4858 | 0 |
| 4859 | 0 |
| 4860 | 0 |
| 4861 | 0 |
| 4862 | 0 |
| 4863 | 0 |
| 4864 | 0 |
| 4865 | 0 |
| 4866 | 1023 |
| 4867 | 1023 |
| 4868 | 1023 |
| 4869 | 1023 |
| 4870 | 1023 |
| 4871 | 1023 |
| 4872 | 1023 |
| 4873 | 1023 |
| 4874 | 1023 |
| 4875 | 1023 |
| 4876 | 1023 |
| 4877 | 1023 |
| 4878 | 1023 |
| 4879 | 1023 |
| 4880 | 1023 |
| 4881 | 1023 |
| 4882 | 1023 |
| 4883 | 1023 |
| 4884 | 1023 |
| 4885 | 1023 |
| 4886 | 1023 |
| 4887 | 1023 |
| 4888 | 1023 |
| 4889 | 1023 |
| 4890 | 1023 |
| 4891 | 1023 |
| 4892 | 1023 |
| 4893 | 1023 |
| 4894 | 1023 |
| 4895 | 1023 |
| 4896 | 1023 |
| 4897 | 1023 |
| 4898 | 1023 |
| 4899 | 1023 |
| 4900 | 1023 |
| 4901 | 1023 |
| 4902 | 1023 |
| 4903 | 1023 |
| 4904 | 0 |
| 4905 | 0 |
| 4906 | 0 |
| 4907 | 0 |
| 4908 | 0 |
| 4909 | 0 |
| 4910 | 0 |
| 4911 | 0 |
| 4912 | 0 |
| 4913 | 0 |
| 4914 | 0 |
| 4915 | 0 |
| 4916 | 0 |
| 4917 | 1023 |
| 4918 | 1023 |
| 4919 | 1023 |
| 4920 | 1023 |
| 4921 | 1023 |
| 4922 | 1023 |
| 4923 | 1023 |
| 4924 | 1023 |
| 4925 | 1023 |
| 4926 | 1023 |
| 4927 | 1023 |
| 4928 | 1023 |
| 4929 | 1023 |
| 4930 | 1023 |
| 4931 | 1023 |
| 4932 | 1023 |
| 4933 | 1023 |
| 4934 | 1023 |
| 4935 | 1023 |
| 4936 | 1023 |
| 4937 | 1023 |
| 4938 | 1023 |
| 4939 | 1023 |
| 4940 | 1023 |
| 4941 | 1023 |
| 4942 | 1023 |
| 4943 | 1023 |
| 4944 | 1023 |
| 4945 | 1023 |
| 4946 | 1023 |
| 4947 | 1023 |
| 4948 | 1023 |
| 4949 | 1023 |
| 4950 | 1023 |
| 4951 | 1023 |
| 4952 | 1023 |
| 4953 | 1023 |
| 4954 | 1023 |
| 4955 | 0 |
| 4956 | 0 |
| 4957 | 0 |
| 4958 | 0 |
| 4959 | 0 |
| 4960 | 0 |
| 4961 | 0 |
| 4962 | 0 |
| 4963 | 0 |
| 4964 | 0 |
| 4965 | 0 |
| 4966 | 0 |
| 4967 | 0 |
| 4968 | 1023 |
| 4969 | 1023 |
| 4970 | 1023 |
| 4971 | 1023 |
| 4972 | 1023 |
| 4973 | 1023 |
| 4974 | 1023 |
| 4975 | 1023 |
| 4976 | 1023 |
| 4977 | 1023 |
| 4978 | 1023 |
| 4979 | 1023 |
| 4980 | 1023 |
| 4981 | 1023 |
| 4982 | 1023 |
| 4983 | 1023 |
| 4984 | 1023 |
| 4985 | 1023 |
| 4986 | 1023 |
| 4987 | 1023 |
| 4988 | 1023 |
| 4989 | 1023 |
| 4990 | 1023 |
| 4991 | 1023 |
| 4992 | 1023 |
| 4993 | 1023 |
| 4994 | 1023 |
| 4995 | 1023 |
| 4996 | 1023 |
| 4997 | 1023 |
| 4998 | 1023 |
| 4999 | 1023 |
| 5000 | 1023 |
| 5001 | 1023 |
| 5002 | 1023 |
| 5003 | 1023 |
| 5004 | 1023 |
| 5005 | 1023 |
| 5006 | 0 |
| 5007 | 0 |
| 5008 | 0 |
| 5009 | 0 |
| 5010 | 0 |
| 5011 | 3 |
| 5012 | 0 |
| 5013 | 0 |
| 5014 | 0 |
| 5015 | 0 |
| 5016 | 0 |
| 5017 | 0 |
| 5018 | 0 |
| 5019 | 1023 |
| 5020 | 1023 |
| 5021 | 1023 |
| 5022 | 1023 |
| 5023 | 1023 |
| 5024 | 1023 |
| 5025 | 1023 |
| 5026 | 1023 |
| 5027 | 1023 |
| 5028 | 1023 |
| 5029 | 1023 |
| 5030 | 1023 |
| 5031 | 1023 |
| 5032 | 1023 |
| 5033 | 1023 |
| 5034 | 1023 |
| 5035 | 1023 |
| 5036 | 1023 |
| 5037 | 1023 |
| 5038 | 1023 |
| 5039 | 1023 |
| 5040 | 1023 |
| 5041 | 1023 |
| 5042 | 1023 |
| 5043 | 1023 |
| 5044 | 1023 |
| 5045 | 1023 |
| 5046 | 1023 |
| 5047 | 1023 |
| 5048 | 1023 |
| 5049 | 1023 |
| 5050 | 1023 |
| 5051 | 1023 |
| 5052 | 1023 |
| 5053 | 1023 |
| 5054 | 1023 |
| 5055 | 1023 |
| 5056 | 1023 |
| 5057 | 0 |
| 5058 | 0 |
| 5059 | 0 |
| 5060 | 0 |
| 5061 | 0 |
| 5062 | 0 |
| 5063 | 0 |
| 5064 | 0 |
| 5065 | 0 |
| 5066 | 0 |
| 5067 | 0 |
| 5068 | 0 |
| 5069 | 0 |
| 5070 | 1023 |
| 5071 | 1023 |
| 5072 | 1023 |
| 5073 | 1023 |
| 5074 | 1023 |
| 5075 | 1023 |
| 5076 | 1023 |
| 5077 | 1023 |
| 5078 | 1023 |
| 5079 | 1023 |
| 5080 | 1023 |
| 5081 | 1023 |
| 5082 | 1023 |
| 5083 | 1023 |
| 5084 | 1023 |
| 5085 | 1023 |
| 5086 | 1023 |
| 5087 | 1023 |
| 5088 | 1023 |
| 5089 | 1023 |
| 5090 | 1023 |
| 5091 | 1023 |
| 5092 | 1023 |
| 5093 | 1023 |
| 5094 | 1023 |
| 5095 | 1023 |
| 5096 | 1023 |
| 5097 | 1023 |
| 5098 | 1023 |
| 5099 | 1023 |
| 5100 | 1023 |
| 5101 | 1023 |
| 5102 | 1023 |
| 5103 | 1023 |
| 5104 | 1023 |
| 5105 | 1023 |
| 5106 | 1023 |
| 5107 | 1023 |
| 5108 | 0 |
| 5109 | 0 |
| 5110 | 0 |
| 5111 | 0 |
| 5112 | 0 |
| 5113 | 0 |
| 5114 | 0 |
| 5115 | 0 |
| 5116 | 0 |
| 5117 | 0 |
| 5118 | 0 |
| 5119 | 0 |
| 5120 | 0 |
| 5121 | 0 |
| 5122 | 1023 |
| 5123 | 1023 |
| 5124 | 1023 |
| 5125 | 1023 |
| 5126 | 1023 |
| 5127 | 1023 |
| 5128 | 1023 |
| 5129 | 1023 |
| 5130 | 1023 |
| 5131 | 1023 |
| 5132 | 1023 |
| 5133 | 1023 |
| 5134 | 1023 |
| 5135 | 1023 |
| 5136 | 1023 |
| 5137 | 1023 |
| 5138 | 1023 |
| 5139 | 1023 |
| 5140 | 1023 |
| 5141 | 1023 |
| 5142 | 1023 |
| 5143 | 1023 |
| 5144 | 1023 |
| 5145 | 1023 |
| 5146 | 1023 |
| 5147 | 1023 |
| 5148 | 1023 |
| 5149 | 1023 |
| 5150 | 1023 |
| 5151 | 1023 |
| 5152 | 1023 |
| 5153 | 1023 |
| 5154 | 1023 |
| 5155 | 1023 |
| 5156 | 1023 |
| 5157 | 1023 |
| 5158 | 1023 |
| 5159 | 0 |
| 5160 | 0 |
| 5161 | 0 |
| 5162 | 0 |
| 5163 | 0 |
| 5164 | 0 |
| 5165 | 0 |
| 5166 | 0 |
| 5167 | 0 |
| 5168 | 0 |
| 5169 | 0 |
| 5170 | 0 |
| 5171 | 0 |
| 5172 | 0 |
| 5173 | 0 |
| 5174 | 1023 |
| 5175 | 1023 |
| 5176 | 1023 |
| 5177 | 1023 |
| 5178 | 1023 |
| 5179 | 1023 |
| 5180 | 1023 |
| 5181 | 1023 |
| 5182 | 1023 |
| 5183 | 1023 |
| 5184 | 1023 |
| 5185 | 1023 |
| 5186 | 1023 |
| 5187 | 1023 |
| 5188 | 1023 |
| 5189 | 1023 |
| 5190 | 1023 |
| 5191 | 1023 |
| 5192 | 1023 |
| 5193 | 1023 |
| 5194 | 1023 |
| 5195 | 1023 |
| 5196 | 1023 |
| 5197 | 1023 |
| 5198 | 1023 |
| 5199 | 1023 |
| 5200 | 1023 |
| 5201 | 1023 |
| 5202 | 1023 |
| 5203 | 1023 |
| 5204 | 1023 |
| 5205 | 1023 |
| 5206 | 1023 |
| 5207 | 1023 |
| 5208 | 1023 |
| 5209 | 1023 |
| 5210 | 1023 |
| 5211 | 0 |
| 5212 | 0 |
| 5213 | 0 |
| 5214 | 0 |
| 5215 | 0 |
| 5216 | 0 |
| 5217 | 0 |
| 5218 | 0 |
| 5219 | 0 |
| 5220 | 0 |
| 5221 | 0 |
| 5222 | 0 |
| 5223 | 0 |
| 5224 | 0 |
| 5225 | 1023 |
| 5226 | 1023 |
| 5227 | 1023 |
| 5228 | 1023 |
| 5229 | 1023 |
| 5230 | 1023 |
| 5231 | 1023 |
| 5232 | 1023 |
| 5233 | 1023 |
| 5234 | 1023 |
| 5235 | 1023 |
| 5236 | 1023 |
| 5237 | 1023 |
| 5238 | 1023 |
| 5239 | 1023 |
| 5240 | 1023 |
| 5241 | 1023 |
| 5242 | 1023 |
| 5243 | 1023 |
| 5244 | 1023 |
| 5245 | 1023 |
| 5246 | 1023 |
| 5247 | 1023 |
| 5248 | 1023 |
| 5249 | 1023 |
| 5250 | 1023 |
| 5251 | 1023 |
| 5252 | 1023 |
| 5253 | 1023 |
| 5254 | 1023 |
| 5255 | 1023 |
| 5256 | 1023 |
| 5257 | 1023 |
| 5258 | 1023 |
| 5259 | 1023 |
| 5260 | 1023 |
| 5261 | 1023 |
| 5262 | 1023 |
| 5263 | 0 |
| 5264 | 0 |
| 5265 | 0 |
| 5266 | 0 |
| 5267 | 0 |
| 5268 | 0 |
| 5269 | 0 |
| 5270 | 0 |
| 5271 | 0 |
| 5272 | 0 |
| 5273 | 0 |
| 5274 | 0 |
| 5275 | 0 |
| 5276 | 0 |
| 5277 | 1023 |
| 5278 | 1023 |
| 5279 | 1023 |
| 5280 | 1023 |
| 5281 | 1023 |
| 5282 | 1023 |
| 5283 | 1023 |
| 5284 | 1023 |
| 5285 | 1023 |
| 5286 | 1023 |
| 5287 | 1023 |
| 5288 | 1023 |
| 5289 | 1023 |
| 5290 | 1023 |
| 5291 | 1023 |
| 5292 | 1023 |
| 5293 | 1023 |
| 5294 | 1023 |
| 5295 | 1023 |
| 5296 | 1023 |
| 5297 | 1023 |
| 5298 | 1023 |
| 5299 | 1023 |
| 5300 | 1023 |
| 5301 | 1023 |
| 5302 | 1023 |
| 5303 | 1023 |
| 5304 | 1023 |
| 5305 | 1023 |
| 5306 | 1023 |
| 5307 | 1023 |
| 5308 | 1023 |
| 5309 | 1023 |
| 5310 | 1023 |
| 5311 | 1023 |
| 5312 | 1023 |
| 5313 | 1023 |
| 5314 | 0 |
| 5315 | 0 |
| 5316 | 0 |
| 5317 | 0 |
| 5318 | 0 |
| 5319 | 0 |
| 5320 | 0 |
| 5321 | 0 |
| 5322 | 0 |
| 5323 | 0 |
| 5324 | 0 |
| 5325 | 0 |
| 5326 | 0 |
| 5327 | 0 |
| 5328 | 0 |
| 5329 | 1023 |
| 5330 | 1023 |
| 5331 | 1023 |
| 5332 | 1023 |
| 5333 | 1023 |
| 5334 | 1023 |
| 5335 | 1023 |
| 5336 | 1023 |
| 5337 | 1023 |
| 5338 | 1023 |
| 5339 | 1023 |
| 5340 | 1023 |
| 5341 | 1023 |
| 5342 | 1023 |
| 5343 | 1023 |
| 5344 | 1023 |
| 5345 | 1023 |
| 5346 | 1023 |
| 5347 | 1023 |
| 5348 | 1023 |
| 5349 | 1023 |
| 5350 | 1023 |
| 5351 | 1023 |
| 5352 | 1023 |
| 5353 | 1023 |
| 5354 | 1023 |
| 5355 | 1023 |
| 5356 | 1023 |
| 5357 | 1023 |
| 5358 | 1023 |
| 5359 | 1023 |
| 5360 | 1023 |
| 5361 | 1023 |
| 5362 | 1023 |
| 5363 | 1023 |
| 5364 | 1023 |
| 5365 | 1023 |
| 5366 | 1023 |
| 5367 | 0 |
| 5368 | 0 |
| 5369 | 0 |
| 5370 | 0 |
| 5371 | 0 |
| 5372 | 0 |
| 5373 | 0 |
| 5374 | 0 |
| 5375 | 0 |
| 5376 | 0 |
| 5377 | 0 |
| 5378 | 0 |
| 5379 | 0 |
| 5380 | 1023 |
| 5381 | 1023 |
| 5382 | 1023 |
| 5383 | 1023 |
| 5384 | 1023 |
| 5385 | 1023 |
| 5386 | 1023 |
| 5387 | 1023 |
| 5388 | 1023 |
| 5389 | 1023 |
| 5390 | 1023 |
| 5391 | 1023 |
| 5392 | 1023 |
| 5393 | 1023 |
| 5394 | 1023 |
| 5395 | 1023 |
| 5396 | 1023 |
| 5397 | 1023 |
| 5398 | 1023 |
| 5399 | 1023 |
| 5400 | 1023 |
| 5401 | 1023 |
| 5402 | 1023 |
| 5403 | 1023 |
| 5404 | 1023 |
| 5405 | 1023 |
| 5406 | 1023 |
| 5407 | 1023 |
| 5408 | 1023 |
| 5409 | 1023 |
| 5410 | 1023 |
| 5411 | 1023 |
| 5412 | 1023 |
| 5413 | 1023 |
| 5414 | 1023 |
| 5415 | 1023 |
| 5416 | 1023 |
| 5417 | 1023 |
| 5418 | 0 |
| 5419 | 0 |
| 5420 | 0 |
| 5421 | 0 |
| 5422 | 1 |
| 5423 | 0 |
| 5424 | 0 |
| 5425 | 0 |
| 5426 | 0 |
| 5427 | 0 |
| 5428 | 0 |
| 5429 | 0 |
| 5430 | 0 |
| 5431 | 1023 |
| 5432 | 1023 |
| 5433 | 1023 |
| 5434 | 1023 |
| 5435 | 1023 |
| 5436 | 1023 |
| 5437 | 1023 |
| 5438 | 1023 |
| 5439 | 1023 |
| 5440 | 1023 |
| 5441 | 1023 |
| 5442 | 1023 |
| 5443 | 1023 |
| 5444 | 1023 |
| 5445 | 1023 |
| 5446 | 1023 |
| 5447 | 1023 |
| 5448 | 1023 |
| 5449 | 1023 |
| 5450 | 1023 |
| 5451 | 1023 |
| 5452 | 1023 |
| 5453 | 1023 |
| 5454 | 1023 |
| 5455 | 1023 |
| 5456 | 1023 |
| 5457 | 1023 |
| 5458 | 1023 |
| 5459 | 1023 |
| 5460 | 1023 |
| 5461 | 1023 |
| 5462 | 1023 |
| 5463 | 1023 |
| 5464 | 1023 |
| 5465 | 1023 |
| 5466 | 1023 |
| 5467 | 1023 |
| 5468 | 1023 |
| 5469 | 0 |
| 5470 | 0 |
| 5471 | 0 |
| 5472 | 0 |
| 5473 | 0 |
| 5474 | 0 |
| 5475 | 0 |
| 5476 | 0 |
| 5477 | 0 |
| 5478 | 0 |
| 5479 | 0 |
| 5480 | 0 |
| 5481 | 0 |
| 5482 | 1023 |
| 5483 | 1023 |
| 5484 | 1023 |
| 5485 | 1023 |
| 5486 | 1023 |
| 5487 | 1023 |
| 5488 | 1023 |
| 5489 | 1023 |
| 5490 | 1023 |
| 5491 | 1023 |
| 5492 | 1023 |
| 5493 | 1023 |
| 5494 | 1023 |
| 5495 | 1023 |
| 5496 | 1023 |
| 5497 | 1023 |
| 5498 | 1023 |
| 5499 | 1023 |
| 5500 | 1023 |
| 5501 | 1023 |
| 5502 | 1023 |
| 5503 | 1023 |
| 5504 | 1023 |
| 5505 | 1023 |
| 5506 | 1023 |
| 5507 | 1023 |
| 5508 | 1023 |
| 5509 | 1023 |
| 5510 | 1023 |
| 5511 | 1023 |
| 5512 | 1023 |
| 5513 | 1023 |
| 5514 | 1023 |
| 5515 | 1023 |
| 5516 | 1023 |
| 5517 | 1023 |
| 5518 | 1023 |
| 5519 | 1023 |
| 5520 | 0 |
| 5521 | 0 |
| 5522 | 0 |
| 5523 | 0 |
| 5524 | 0 |
| 5525 | 0 |
| 5526 | 0 |
| 5527 | 0 |
| 5528 | 0 |
| 5529 | 0 |
| 5530 | 0 |
| 5531 | 0 |
| 5532 | 0 |
| 5533 | 1023 |
| 5534 | 1023 |
| 5535 | 1023 |
| 5536 | 1023 |
| 5537 | 1023 |
| 5538 | 1023 |
| 5539 | 1023 |
| 5540 | 1023 |
| 5541 | 1023 |
| 5542 | 1023 |
| 5543 | 1023 |
| 5544 | 1023 |
| 5545 | 1023 |
| 5546 | 1023 |
| 5547 | 1023 |
| 5548 | 1023 |
| 5549 | 1023 |
| 5550 | 1023 |
| 5551 | 1023 |
| 5552 | 1023 |
| 5553 | 1023 |
| 5554 | 1023 |
| 5555 | 1023 |
| 5556 | 1023 |
| 5557 | 1023 |
| 5558 | 1023 |
| 5559 | 1023 |
| 5560 | 1023 |
| 5561 | 1023 |
| 5562 | 1023 |
| 5563 | 1023 |
| 5564 | 1023 |
| 5565 | 1023 |
| 5566 | 1023 |
| 5567 | 1023 |
| 5568 | 1023 |
| 5569 | 1023 |
| 5570 | 1023 |
| 5571 | 0 |
| 5572 | 0 |
| 5573 | 0 |
| 5574 | 0 |
| 5575 | 0 |
| 5576 | 0 |
| 5577 | 0 |
| 5578 | 0 |
| 5579 | 0 |
| 5580 | 0 |
| 5581 | 0 |
| 5582 | 0 |
| 5583 | 0 |
| 5584 | 1023 |
| 5585 | 1023 |
| 5586 | 1023 |
| 5587 | 1023 |
| 5588 | 1023 |
| 5589 | 1023 |
| 5590 | 1023 |
| 5591 | 1023 |
| 5592 | 1023 |
| 5593 | 1023 |
| 5594 | 1023 |
| 5595 | 1023 |
| 5596 | 1023 |
| 5597 | 1023 |
| 5598 | 1023 |
| 5599 | 1023 |
| 5600 | 1023 |
| 5601 | 1023 |
| 5602 | 1023 |
| 5603 | 1023 |
| 5604 | 1023 |
| 5605 | 1023 |
| 5606 | 1023 |
| 5607 | 1023 |
| 5608 | 1023 |
| 5609 | 1023 |
| 5610 | 1023 |
| 5611 | 1023 |
| 5612 | 1023 |
| 5613 | 1023 |
| 5614 | 1023 |
| 5615 | 1023 |
| 5616 | 1023 |
| 5617 | 1023 |
| 5618 | 1023 |
| 5619 | 1023 |
| 5620 | 1023 |
| 5621 | 1023 |
| 5622 | 0 |
| 5623 | 0 |
| 5624 | 0 |
| 5625 | 0 |
| 5626 | 0 |
| 5627 | 0 |
| 5628 | 0 |
| 5629 | 0 |
| 5630 | 0 |
| 5631 | 0 |
| 5632 | 0 |
| 5633 | 0 |
| 5634 | 0 |
| 5635 | 1023 |
| 5636 | 1023 |
| 5637 | 1023 |
| 5638 | 1023 |
| 5639 | 1023 |
| 5640 | 1023 |
| 5641 | 1023 |
| 5642 | 1023 |
| 5643 | 1023 |
| 5644 | 1023 |
| 5645 | 1023 |
| 5646 | 1023 |
| 5647 | 1023 |
| 5648 | 1023 |
| 5649 | 1023 |
| 5650 | 1023 |
| 5651 | 1023 |
| 5652 | 1023 |
| 5653 | 1023 |
| 5654 | 1023 |
| 5655 | 1023 |
| 5656 | 1023 |
| 5657 | 1023 |
| 5658 | 1023 |
| 5659 | 1023 |
| 5660 | 1023 |
| 5661 | 1023 |
| 5662 | 1023 |
| 5663 | 1023 |
| 5664 | 1023 |
| 5665 | 1023 |
| 5666 | 1023 |
| 5667 | 1023 |
| 5668 | 1023 |
| 5669 | 1023 |
| 5670 | 1023 |
| 5671 | 1023 |
| 5672 | 1023 |
| 5673 | 0 |
| 5674 | 0 |
| 5675 | 0 |
| 5676 | 0 |
| 5677 | 0 |
| 5678 | 0 |
| 5679 | 0 |
| 5680 | 0 |
| 5681 | 0 |
| 5682 | 0 |
| 5683 | 0 |
| 5684 | 0 |
| 5685 | 0 |
| 5686 | 0 |
| 5687 | 1023 |
| 5688 | 1023 |
| 5689 | 1023 |
| 5690 | 1023 |
| 5691 | 1023 |
| 5692 | 1023 |
| 5693 | 1023 |
| 5694 | 1023 |
| 5695 | 1023 |
| 5696 | 1023 |
| 5697 | 1023 |
| 5698 | 1023 |
| 5699 | 1023 |
| 5700 | 1023 |
| 5701 | 1023 |
| 5702 | 1023 |
| 5703 | 1023 |
| 5704 | 1023 |
| 5705 | 1023 |
| 5706 | 1023 |
| 5707 | 1023 |
| 5708 | 1023 |
| 5709 | 1023 |
| 5710 | 1023 |
| 5711 | 1023 |
| 5712 | 1023 |
| 5713 | 1023 |
| 5714 | 1023 |
| 5715 | 1023 |
| 5716 | 1023 |
| 5717 | 1023 |
| 5718 | 1023 |
| 5719 | 1023 |
| 5720 | 1023 |
| 5721 | 1023 |
| 5722 | 1023 |
| 5723 | 1023 |
| 5724 | 0 |
| 5725 | 0 |
| 5726 | 0 |
| 5727 | 0 |
| 5728 | 0 |
| 5729 | 0 |
| 5730 | 0 |
| 5731 | 0 |
| 5732 | 0 |
| 5733 | 0 |
| 5734 | 0 |
| 5735 | 0 |
| 5736 | 0 |
| 5737 | 0 |
| 5738 | 1023 |
| 5739 | 1023 |
| 5740 | 1023 |
| 5741 | 1023 |
| 5742 | 1023 |
| 5743 | 1023 |
| 5744 | 1023 |
| 5745 | 1023 |
| 5746 | 1023 |
| 5747 | 1023 |
| 5748 | 1023 |
| 5749 | 1023 |
| 5750 | 1023 |
| 5751 | 1023 |
| 5752 | 1023 |
| 5753 | 1023 |
| 5754 | 1023 |
| 5755 | 1023 |
| 5756 | 1023 |
| 5757 | 1023 |
| 5758 | 1023 |
| 5759 | 1023 |
| 5760 | 1023 |
| 5761 | 1023 |
| 5762 | 1023 |
| 5763 | 1023 |
| 5764 | 1023 |
| 5765 | 1023 |
| 5766 | 1023 |
| 5767 | 1023 |
| 5768 | 1023 |
| 5769 | 1023 |
| 5770 | 1023 |
| 5771 | 1023 |
| 5772 | 1023 |
| 5773 | 1023 |
| 5774 | 1023 |
| 5775 | 1023 |
| 5776 | 0 |
| 5777 | 0 |
| 5778 | 0 |
| 5779 | 0 |
| 5780 | 0 |
| 5781 | 0 |
| 5782 | 0 |
| 5783 | 0 |
| 5784 | 0 |
| 5785 | 0 |
| 5786 | 0 |
| 5787 | 0 |
| 5788 | 0 |
| 5789 | 0 |
| 5790 | 1023 |
| 5791 | 1023 |
| 5792 | 1023 |
| 5793 | 1023 |
| 5794 | 1023 |
| 5795 | 1023 |
| 5796 | 1023 |
| 5797 | 1023 |
| 5798 | 1023 |
| 5799 | 1023 |
| 5800 | 1023 |
| 5801 | 1023 |
| 5802 | 1023 |
| 5803 | 1023 |
| 5804 | 1023 |
| 5805 | 1023 |
| 5806 | 1023 |
| 5807 | 1023 |
| 5808 | 1023 |
| 5809 | 1023 |
| 5810 | 1023 |
| 5811 | 1023 |
| 5812 | 1023 |
| 5813 | 1023 |
| 5814 | 1023 |
| 5815 | 1023 |
| 5816 | 1023 |
| 5817 | 1023 |
| 5818 | 1023 |
| 5819 | 1023 |
| 5820 | 1023 |
| 5821 | 1023 |
| 5822 | 1023 |
| 5823 | 1023 |
| 5824 | 1023 |
| 5825 | 1023 |
| 5826 | 1023 |
| 5827 | 0 |
| 5828 | 0 |
| 5829 | 0 |
| 5830 | 0 |
| 5831 | 0 |
| 5832 | 0 |
| 5833 | 0 |
| 5834 | 0 |
| 5835 | 0 |
| 5836 | 0 |
| 5837 | 0 |
| 5838 | 0 |
| 5839 | 0 |
| 5840 | 0 |
| 5841 | 0 |
| 5842 | 1023 |
| 5843 | 1023 |
| 5844 | 1023 |
| 5845 | 1023 |
| 5846 | 1023 |
| 5847 | 1023 |
| 5848 | 1023 |
| 5849 | 1023 |
| 5850 | 1023 |
| 5851 | 1023 |
| 5852 | 1023 |
| 5853 | 1023 |
| 5854 | 1023 |
| 5855 | 1023 |
| 5856 | 1023 |
| 5857 | 1023 |
| 5858 | 1023 |
| 5859 | 1023 |
| 5860 | 1023 |
| 5861 | 1023 |
| 5862 | 1023 |
| 5863 | 1023 |
| 5864 | 1023 |
| 5865 | 1023 |
| 5866 | 1023 |
| 5867 | 1023 |
| 5868 | 1023 |
| 5869 | 1023 |
| 5870 | 1023 |
| 5871 | 1023 |
| 5872 | 1023 |
| 5873 | 1023 |
| 5874 | 1023 |
| 5875 | 1023 |
| 5876 | 1023 |
| 5877 | 1023 |
| 5878 | 1023 |
| 5879 | 0 |
| 5880 | 0 |
| 5881 | 0 |
| 5882 | 0 |
| 5883 | 0 |
| 5884 | 0 |
| 5885 | 0 |
| 5886 | 0 |
| 5887 | 0 |
| 5888 | 0 |
| 5889 | 0 |
| 5890 | 0 |
| 5891 | 0 |
| 5892 | 0 |
| 5893 | 0 |
| 5894 | 1023 |
| 5895 | 1023 |
| 5896 | 1023 |
| 5897 | 1023 |
| 5898 | 1023 |
| 5899 | 1023 |
| 5900 | 1023 |
| 5901 | 1023 |
| 5902 | 1023 |
| 5903 | 1023 |
| 5904 | 1023 |
| 5905 | 1023 |
| 5906 | 1023 |
| 5907 | 1023 |
| 5908 | 1023 |
| 5909 | 1023 |
| 5910 | 1023 |
| 5911 | 1023 |
| 5912 | 1023 |
| 5913 | 1023 |
| 5914 | 1023 |
| 5915 | 1023 |
| 5916 | 1023 |
| 5917 | 1023 |
| 5918 | 1023 |
| 5919 | 1023 |
| 5920 | 1023 |
| 5921 | 1023 |
| 5922 | 1023 |
| 5923 | 1023 |
| 5924 | 1023 |
| 5925 | 1023 |
| 5926 | 1023 |
| 5927 | 1023 |
| 5928 | 1023 |
| 5929 | 1023 |
| 5930 | 1023 |
| 5931 | 0 |
| 5932 | 0 |
| 5933 | 0 |
| 5934 | 0 |
| 5935 | 0 |
| 5936 | 0 |
| 5937 | 0 |
| 5938 | 0 |
| 5939 | 0 |
| 5940 | 0 |
| 5941 | 0 |
| 5942 | 0 |
| 5943 | 0 |
| 5944 | 0 |
| 5945 | 0 |
| 5946 | 1023 |
| 5947 | 1023 |
| 5948 | 1023 |
| 5949 | 1023 |
| 5950 | 1023 |
| 5951 | 1023 |
| 5952 | 1023 |
| 5953 | 1023 |
| 5954 | 1023 |
| 5955 | 1023 |
| 5956 | 1023 |
| 5957 | 1023 |
| 5958 | 1023 |
| 5959 | 1023 |
| 5960 | 1023 |
| 5961 | 1023 |
| 5962 | 1023 |
| 5963 | 1023 |
| 5964 | 1023 |
| 5965 | 1023 |
| 5966 | 1023 |
| 5967 | 1023 |
| 5968 | 1023 |
| 5969 | 1023 |
| 5970 | 1023 |
| 5971 | 1023 |
| 5972 | 1023 |
| 5973 | 1023 |
| 5974 | 1023 |
| 5975 | 1023 |
| 5976 | 1023 |
| 5977 | 1023 |
| 5978 | 1023 |
| 5979 | 1023 |
| 5980 | 1023 |
| 5981 | 1023 |
| 5982 | 1023 |
| 5983 | 0 |
| 5984 | 0 |
| 5985 | 0 |
| 5986 | 0 |
| 5987 | 0 |
| 5988 | 0 |
| 5989 | 0 |
| 5990 | 0 |
| 5991 | 0 |
| 5992 | 0 |
| 5993 | 0 |
| 5994 | 0 |
| 5995 | 0 |
| 5996 | 0 |
| 5997 | 0 |
| 5998 | 1023 |
| 5999 | 1023 |
| 6000 | 1023 |
| 6001 | 1023 |
| 6002 | 1023 |
| 6003 | 1023 |
| 6004 | 1023 |
| 6005 | 1023 |
| 6006 | 1023 |
| 6007 | 1023 |
| 6008 | 1023 |
| 6009 | 1023 |
| 6010 | 1023 |
| 6011 | 1023 |
| 6012 | 1023 |
| 6013 | 1023 |
| 6014 | 1023 |
| 6015 | 1023 |
| 6016 | 1023 |
| 6017 | 1023 |
| 6018 | 1023 |
| 6019 | 1023 |
| 6020 | 1023 |
| 6021 | 1023 |
| 6022 | 1023 |
| 6023 | 1023 |
| 6024 | 1023 |
| 6025 | 1023 |
| 6026 | 1023 |
| 6027 | 1023 |
| 6028 | 1023 |
| 6029 | 1023 |
| 6030 | 1023 |
| 6031 | 1023 |
| 6032 | 1023 |
| 6033 | 1023 |
| 6034 | 1023 |
| 6035 | 1023 |
| 6036 | 0 |
| 6037 | 0 |
| 6038 | 0 |
| 6039 | 0 |
| 6040 | 0 |
| 6041 | 0 |
| 6042 | 0 |
| 6043 | 0 |
| 6044 | 0 |
| 6045 | 0 |
| 6046 | 0 |
| 6047 | 0 |
| 6048 | 0 |
| 6049 | 1023 |
| 6050 | 1023 |
| 6051 | 1023 |
| 6052 | 1023 |
| 6053 | 1023 |
| 6054 | 1023 |
| 6055 | 1023 |
| 6056 | 1023 |
| 6057 | 1023 |
| 6058 | 1023 |
| 6059 | 1023 |
| 6060 | 1023 |
| 6061 | 1023 |
| 6062 | 1023 |
| 6063 | 1023 |
| 6064 | 1023 |
| 6065 | 1023 |
| 6066 | 1023 |
| 6067 | 1023 |
| 6068 | 1023 |
| 6069 | 1023 |
| 6070 | 1023 |
| 6071 | 1023 |
| 6072 | 1023 |
| 6073 | 1023 |
| 6074 | 1023 |
| 6075 | 1023 |
| 6076 | 1023 |
| 6077 | 1023 |
| 6078 | 1023 |
| 6079 | 1023 |
| 6080 | 1023 |
| 6081 | 1023 |
| 6082 | 1023 |
| 6083 | 1023 |
| 6084 | 1023 |
| 6085 | 1023 |
| 6086 | 1023 |
| 6087 | 0 |
| 6088 | 0 |
| 6089 | 0 |
| 6090 | 0 |
| 6091 | 0 |
| 6092 | 0 |
| 6093 | 0 |
| 6094 | 0 |
| 6095 | 0 |
| 6096 | 0 |
| 6097 | 0 |
| 6098 | 0 |
| 6099 | 0 |
| 6100 | 1023 |
| 6101 | 1023 |
| 6102 | 1023 |
| 6103 | 1023 |
| 6104 | 1023 |
| 6105 | 1023 |
| 6106 | 1023 |
| 6107 | 1023 |
| 6108 | 1023 |
| 6109 | 1023 |
| 6110 | 1023 |
| 6111 | 1023 |
| 6112 | 1023 |
| 6113 | 1023 |
| 6114 | 1023 |
| 6115 | 1023 |
| 6116 | 1023 |
| 6117 | 1023 |
| 6118 | 1023 |
| 6119 | 1023 |
| 6120 | 1023 |
| 6121 | 1023 |
| 6122 | 1023 |
| 6123 | 1023 |
| 6124 | 1023 |
| 6125 | 1023 |
| 6126 | 1023 |
| 6127 | 1023 |
| 6128 | 1023 |
| 6129 | 1023 |
| 6130 | 1023 |
| 6131 | 1023 |
| 6132 | 1023 |
| 6133 | 1023 |
| 6134 | 1023 |
| 6135 | 1023 |
| 6136 | 1023 |
| 6137 | 1023 |
| 6138 | 0 |
| 6139 | 0 |
| 6140 | 0 |
| 6141 | 0 |
| 6142 | 0 |
| 6143 | 0 |
| 6144 | 0 |
| 6145 | 0 |
| 6146 | 0 |
| 6147 | 0 |
| 6148 | 0 |
| 6149 | 0 |
| 6150 | 0 |
| 6151 | 1023 |
| 6152 | 1023 |
| 6153 | 1023 |
| 6154 | 1023 |
| 6155 | 1023 |
| 6156 | 1023 |
| 6157 | 1023 |
| 6158 | 1023 |
| 6159 | 1023 |
| 6160 | 1023 |
| 6161 | 1023 |
| 6162 | 1023 |
| 6163 | 1023 |
| 6164 | 1023 |
| 6165 | 1023 |
| 6166 | 1023 |
| 6167 | 1023 |
| 6168 | 1023 |
| 6169 | 1023 |
| 6170 | 1023 |
| 6171 | 1023 |
| 6172 | 1023 |
| 6173 | 1023 |
| 6174 | 1023 |
| 6175 | 1023 |
| 6176 | 1023 |
| 6177 | 1023 |
| 6178 | 1023 |
| 6179 | 1023 |
| 6180 | 1023 |
| 6181 | 1023 |
| 6182 | 1023 |
| 6183 | 1023 |
| 6184 | 1023 |
| 6185 | 1023 |
| 6186 | 1023 |
| 6187 | 1023 |
| 6188 | 1023 |
| 6189 | 0 |
| 6190 | 0 |
| 6191 | 0 |
| 6192 | 0 |
| 6193 | 0 |
| 6194 | 0 |
| 6195 | 0 |
| 6196 | 0 |
| 6197 | 0 |
| 6198 | 0 |
| 6199 | 0 |
| 6200 | 0 |
| 6201 | 0 |
| 6202 | 1023 |
| 6203 | 1023 |
| 6204 | 1023 |
| 6205 | 1023 |
| 6206 | 1023 |
| 6207 | 1023 |
| 6208 | 1023 |
| 6209 | 1023 |
| 6210 | 1023 |
| 6211 | 1023 |
| 6212 | 1023 |
| 6213 | 1023 |
| 6214 | 1023 |
| 6215 | 1023 |
| 6216 | 1023 |
| 6217 | 1023 |
| 6218 | 1023 |
| 6219 | 1023 |
| 6220 | 1023 |
| 6221 | 1023 |
| 6222 | 1023 |
| 6223 | 1023 |
| 6224 | 1023 |
| 6225 | 1023 |
| 6226 | 1023 |
| 6227 | 1023 |
| 6228 | 1023 |
| 6229 | 1023 |
| 6230 | 1023 |
| 6231 | 1023 |
| 6232 | 1023 |
| 6233 | 1023 |
| 6234 | 1023 |
| 6235 | 1023 |
| 6236 | 1023 |
| 6237 | 1023 |
| 6238 | 1023 |
| 6239 | 1023 |
| 6240 | 0 |
| 6241 | 0 |
| 6242 | 0 |
| 6243 | 0 |
| 6244 | 0 |
| 6245 | 0 |
| 6246 | 0 |
| 6247 | 0 |
| 6248 | 0 |
| 6249 | 0 |
| 6250 | 0 |
| 6251 | 0 |
| 6252 | 0 |
| 6253 | 1023 |
| 6254 | 1023 |
| 6255 | 1023 |
| 6256 | 1023 |
| 6257 | 1023 |
| 6258 | 1023 |
| 6259 | 1023 |
| 6260 | 1023 |
| 6261 | 1023 |
| 6262 | 1023 |
| 6263 | 1023 |
| 6264 | 1023 |
| 6265 | 1023 |
| 6266 | 1023 |
| 6267 | 1023 |
| 6268 | 1023 |
| 6269 | 1023 |
| 6270 | 1023 |
| 6271 | 1023 |
| 6272 | 1023 |
| 6273 | 1023 |
| 6274 | 1023 |
| 6275 | 1023 |
| 6276 | 1023 |
| 6277 | 1023 |
| 6278 | 1023 |
| 6279 | 1023 |
| 6280 | 1023 |
| 6281 | 1023 |
| 6282 | 1023 |
| 6283 | 1023 |
| 6284 | 1023 |
| 6285 | 1023 |
| 6286 | 1023 |
| 6287 | 1023 |
| 6288 | 1023 |
| 6289 | 1023 |
| 6290 | 1023 |
| 6291 | 0 |
| 6292 | 0 |
| 6293 | 0 |
| 6294 | 0 |
| 6295 | 0 |
| 6296 | 0 |
| 6297 | 0 |
| 6298 | 0 |
| 6299 | 0 |
| 6300 | 0 |
| 6301 | 0 |
| 6302 | 0 |
| 6303 | 0 |
| 6304 | 1023 |
| 6305 | 1023 |
| 6306 | 1023 |
| 6307 | 1023 |
| 6308 | 1023 |
| 6309 | 1023 |
| 6310 | 1023 |
| 6311 | 1023 |
| 6312 | 1023 |
| 6313 | 1023 |
| 6314 | 1023 |
| 6315 | 1023 |
| 6316 | 1023 |
| 6317 | 1023 |
| 6318 | 1023 |
| 6319 | 1023 |
| 6320 | 1023 |
| 6321 | 1023 |
| 6322 | 1023 |
| 6323 | 1023 |
| 6324 | 1023 |
| 6325 | 1023 |
| 6326 | 1023 |
| 6327 | 1023 |
| 6328 | 1023 |
| 6329 | 1023 |
| 6330 | 1023 |
| 6331 | 1023 |
| 6332 | 1023 |
| 6333 | 1023 |
| 6334 | 1023 |
| 6335 | 1023 |
| 6336 | 1023 |
| 6337 | 1023 |
| 6338 | 1023 |
| 6339 | 1023 |
| 6340 | 1023 |
| 6341 | 1023 |
| 6342 | 0 |
| 6343 | 0 |
| 6344 | 0 |
| 6345 | 0 |
| 6346 | 0 |
| 6347 | 0 |
| 6348 | 0 |
| 6349 | 0 |
| 6350 | 0 |
| 6351 | 0 |
| 6352 | 0 |
| 6353 | 0 |
| 6354 | 0 |
| 6355 | 0 |
| 6356 | 1023 |
| 6357 | 1023 |
| 6358 | 1023 |
| 6359 | 1023 |
| 6360 | 1023 |
| 6361 | 1023 |
| 6362 | 1023 |
| 6363 | 1023 |
| 6364 | 1023 |
| 6365 | 1023 |
| 6366 | 1023 |
| 6367 | 1023 |
| 6368 | 1023 |
| 6369 | 1023 |
| 6370 | 1023 |
| 6371 | 1023 |
| 6372 | 1023 |
| 6373 | 1023 |
| 6374 | 1023 |
| 6375 | 1023 |
| 6376 | 1023 |
| 6377 | 1023 |
| 6378 | 1023 |
| 6379 | 1023 |
| 6380 | 1023 |
| 6381 | 1023 |
| 6382 | 1023 |
| 6383 | 1023 |
| 6384 | 1023 |
| 6385 | 1023 |
| 6386 | 1023 |
| 6387 | 1023 |
| 6388 | 1023 |
| 6389 | 1023 |
| 6390 | 1023 |
| 6391 | 1023 |
| 6392 | 1023 |
| 6393 | 0 |
| 6394 | 0 |
| 6395 | 0 |
| 6396 | 0 |
| 6397 | 0 |
| 6398 | 0 |
| 6399 | 0 |
| 6400 | 0 |
| 6401 | 0 |
| 6402 | 0 |
| 6403 | 0 |
| 6404 | 0 |
| 6405 | 0 |
| 6406 | 0 |
| 6407 | 0 |
| 6408 | 1023 |
| 6409 | 1023 |
| 6410 | 1023 |
| 6411 | 1023 |
| 6412 | 1023 |
| 6413 | 1023 |
| 6414 | 1023 |
| 6415 | 1023 |
| 6416 | 1023 |
| 6417 | 1023 |
| 6418 | 1023 |
| 6419 | 1023 |
| 6420 | 1023 |
| 6421 | 1023 |
| 6422 | 1023 |
| 6423 | 1023 |
| 6424 | 1023 |
| 6425 | 1023 |
| 6426 | 1023 |
| 6427 | 1023 |
| 6428 | 1023 |
| 6429 | 1023 |
| 6430 | 1023 |
| 6431 | 1023 |
| 6432 | 1023 |
| 6433 | 1023 |
| 6434 | 1023 |
| 6435 | 1023 |
| 6436 | 1023 |
| 6437 | 1023 |
| 6438 | 1023 |
| 6439 | 1023 |
| 6440 | 1023 |
| 6441 | 1023 |
| 6442 | 1023 |
| 6443 | 1023 |
| 6444 | 1023 |
| 6445 | 0 |
| 6446 | 0 |
| 6447 | 0 |
| 6448 | 0 |
| 6449 | 0 |
| 6450 | 0 |
| 6451 | 0 |
| 6452 | 0 |
| 6453 | 0 |
| 6454 | 0 |
| 6455 | 0 |
| 6456 | 0 |
| 6457 | 0 |
| 6458 | 0 |
| 6459 | 0 |
| 6460 | 1023 |
| 6461 | 1023 |
| 6462 | 1023 |
| 6463 | 1023 |
| 6464 | 1023 |
| 6465 | 1023 |
| 6466 | 1023 |
| 6467 | 1023 |
| 6468 | 1023 |
| 6469 | 1023 |
| 6470 | 1023 |
| 6471 | 1023 |
| 6472 | 1023 |
| 6473 | 1023 |
| 6474 | 1023 |
| 6475 | 1023 |
| 6476 | 1023 |
| 6477 | 1023 |
| 6478 | 1023 |
| 6479 | 1023 |
| 6480 | 1023 |
| 6481 | 1023 |
| 6482 | 1023 |
| 6483 | 1023 |
| 6484 | 1023 |
| 6485 | 1023 |
| 6486 | 1023 |
| 6487 | 1023 |
| 6488 | 1023 |
| 6489 | 1023 |
| 6490 | 1023 |
| 6491 | 1023 |
| 6492 | 1023 |
| 6493 | 1023 |
| 6494 | 1023 |
| 6495 | 1023 |
| 6496 | 1023 |
| 6497 | 0 |
| 6498 | 0 |
| 6499 | 0 |
| 6500 | 0 |
| 6501 | 0 |
| 6502 | 0 |
| 6503 | 0 |
| 6504 | 0 |
| 6505 | 0 |
| 6506 | 0 |
| 6507 | 0 |
| 6508 | 0 |
| 6509 | 0 |
| 6510 | 0 |
| 6511 | 0 |
| 6512 | 1023 |
| 6513 | 1023 |
| 6514 | 1023 |
| 6515 | 1023 |
| 6516 | 1023 |
| 6517 | 1023 |
| 6518 | 1023 |
| 6519 | 1023 |
| 6520 | 1023 |
| 6521 | 1023 |
| 6522 | 1023 |
| 6523 | 1023 |
| 6524 | 1023 |
| 6525 | 1023 |
| 6526 | 1023 |
| 6527 | 1023 |
| 6528 | 1023 |
| 6529 | 1023 |
| 6530 | 1023 |
| 6531 | 1023 |
| 6532 | 1023 |
| 6533 | 1023 |
| 6534 | 1023 |
| 6535 | 1023 |
| 6536 | 1023 |
| 6537 | 1023 |
| 6538 | 1023 |
| 6539 | 1023 |
| 6540 | 1023 |
| 6541 | 1023 |
| 6542 | 1023 |
| 6543 | 1023 |
| 6544 | 1023 |
| 6545 | 1023 |
| 6546 | 1023 |
| 6547 | 1023 |
| 6548 | 1023 |
| 6549 | 0 |
| 6550 | 0 |
| 6551 | 0 |
| 6552 | 0 |
| 6553 | 0 |
| 6554 | 0 |
| 6555 | 0 |
| 6556 | 0 |
| 6557 | 0 |
| 6558 | 0 |
| 6559 | 0 |
| 6560 | 0 |
| 6561 | 0 |
| 6562 | 0 |
| 6563 | 0 |
| 6564 | 1023 |
| 6565 | 1023 |
| 6566 | 1023 |
| 6567 | 1023 |
| 6568 | 1023 |
| 6569 | 1023 |
| 6570 | 1023 |
| 6571 | 1023 |
| 6572 | 1023 |
| 6573 | 1023 |
| 6574 | 1023 |
| 6575 | 1023 |
| 6576 | 1023 |
| 6577 | 1023 |
| 6578 | 1023 |
| 6579 | 1023 |
| 6580 | 1023 |
| 6581 | 1023 |
| 6582 | 1023 |
| 6583 | 1023 |
| 6584 | 1023 |
| 6585 | 1023 |
| 6586 | 1023 |
| 6587 | 1023 |
| 6588 | 1023 |
| 6589 | 1023 |
| 6590 | 1023 |
| 6591 | 1023 |
| 6592 | 1023 |
| 6593 | 1023 |
| 6594 | 1023 |
| 6595 | 1023 |
| 6596 | 1023 |
| 6597 | 1023 |
| 6598 | 1023 |
| 6599 | 1023 |
| 6600 | 1023 |
| 6601 | 1023 |
| 6602 | 0 |
| 6603 | 0 |
| 6604 | 0 |
| 6605 | 0 |
| 6606 | 0 |
| 6607 | 0 |
| 6608 | 0 |
| 6609 | 0 |
| 6610 | 0 |
| 6611 | 0 |
| 6612 | 0 |
| 6613 | 0 |
| 6614 | 0 |
| 6615 | 1023 |
| 6616 | 1023 |
| 6617 | 1023 |
| 6618 | 1023 |
| 6619 | 1023 |
| 6620 | 1023 |
| 6621 | 1023 |
| 6622 | 1023 |
| 6623 | 1023 |
| 6624 | 1023 |
| 6625 | 1023 |
| 6626 | 1023 |
| 6627 | 1023 |
| 6628 | 1023 |
| 6629 | 1023 |
| 6630 | 1023 |
| 6631 | 1023 |
| 6632 | 1023 |
| 6633 | 1023 |
| 6634 | 1023 |
| 6635 | 1023 |
| 6636 | 1023 |
| 6637 | 1023 |
| 6638 | 1023 |
| 6639 | 1023 |
| 6640 | 1023 |
| 6641 | 1023 |
| 6642 | 1023 |
| 6643 | 1023 |
| 6644 | 1023 |
| 6645 | 1023 |
| 6646 | 1023 |
| 6647 | 1023 |
| 6648 | 1023 |
| 6649 | 1023 |
| 6650 | 1023 |
| 6651 | 1023 |
| 6652 | 1023 |
| 6653 | 0 |
| 6654 | 1 |
| 6655 | 0 |
| 6656 | 0 |
| 6657 | 0 |
| 6658 | 0 |
| 6659 | 0 |
| 6660 | 0 |
| 6661 | 0 |
| 6662 | 0 |
| 6663 | 0 |
| 6664 | 0 |
| 6665 | 0 |
| 6666 | 1023 |
| 6667 | 1023 |
| 6668 | 1023 |
| 6669 | 1023 |
| 6670 | 1023 |
| 6671 | 1023 |
| 6672 | 1023 |
| 6673 | 1023 |
| 6674 | 1023 |
| 6675 | 1023 |
| 6676 | 1023 |
| 6677 | 1023 |
| 6678 | 1023 |
| 6679 | 1023 |
| 6680 | 1023 |
| 6681 | 1023 |
| 6682 | 1023 |
| 6683 | 1023 |
| 6684 | 1023 |
| 6685 | 1023 |
| 6686 | 1023 |
| 6687 | 1023 |
| 6688 | 1023 |
| 6689 | 1023 |
| 6690 | 1023 |
| 6691 | 1023 |
| 6692 | 1023 |
| 6693 | 1023 |
| 6694 | 1023 |
| 6695 | 1023 |
| 6696 | 1023 |
| 6697 | 1023 |
| 6698 | 1023 |
| 6699 | 1023 |
| 6700 | 1023 |
| 6701 | 1023 |
| 6702 | 1023 |
| 6703 | 1023 |
| 6704 | 0 |
| 6705 | 0 |
| 6706 | 0 |
| 6707 | 0 |
| 6708 | 0 |
| 6709 | 0 |
| 6710 | 0 |
| 6711 | 0 |
| 6712 | 0 |
| 6713 | 0 |
| 6714 | 0 |
| 6715 | 0 |
| 6716 | 0 |
| 6717 | 1023 |
| 6718 | 1023 |
| 6719 | 1023 |
| 6720 | 1023 |
| 6721 | 1023 |
| 6722 | 1023 |
| 6723 | 1023 |
| 6724 | 1023 |
| 6725 | 1023 |
| 6726 | 1023 |
| 6727 | 1023 |
| 6728 | 1023 |
| 6729 | 1023 |
| 6730 | 1023 |
| 6731 | 1023 |
| 6732 | 1023 |
| 6733 | 1023 |
| 6734 | 1023 |
| 6735 | 1023 |
| 6736 | 1023 |
| 6737 | 1023 |
| 6738 | 1023 |
| 6739 | 1023 |
| 6740 | 1023 |
| 6741 | 1023 |
| 6742 | 1023 |
| 6743 | 1023 |
| 6744 | 1023 |
| 6745 | 1023 |
| 6746 | 1023 |
| 6747 | 1023 |
| 6748 | 1023 |
| 6749 | 1023 |
| 6750 | 1023 |
| 6751 | 1023 |
| 6752 | 1023 |
| 6753 | 1023 |
| 6754 | 1023 |
| 6755 | 0 |
| 6756 | 0 |
| 6757 | 0 |
| 6758 | 0 |
| 6759 | 0 |
| 6760 | 0 |
| 6761 | 0 |
| 6762 | 0 |
| 6763 | 0 |
| 6764 | 0 |
| 6765 | 0 |
| 6766 | 0 |
| 6767 | 0 |
| 6768 | 1023 |
| 6769 | 1023 |
| 6770 | 1023 |
| 6771 | 1023 |
| 6772 | 1023 |
| 6773 | 1023 |
| 6774 | 1023 |
| 6775 | 1023 |
| 6776 | 1023 |
| 6777 | 1023 |
| 6778 | 1023 |
| 6779 | 1023 |
| 6780 | 1023 |
| 6781 | 1023 |
| 6782 | 1023 |
| 6783 | 1023 |
| 6784 | 1023 |
| 6785 | 1023 |
| 6786 | 1023 |
| 6787 | 1023 |
| 6788 | 1023 |
| 6789 | 1023 |
| 6790 | 1023 |
| 6791 | 1023 |
| 6792 | 1023 |
| 6793 | 1023 |
| 6794 | 1023 |
| 6795 | 1023 |
| 6796 | 1023 |
| 6797 | 1023 |
| 6798 | 1023 |
| 6799 | 1023 |
| 6800 | 1023 |
| 6801 | 1023 |
| 6802 | 1023 |
| 6803 | 1023 |
| 6804 | 1023 |
| 6805 | 1023 |
| 6806 | 0 |
| 6807 | 0 |
| 6808 | 0 |
| 6809 | 0 |
| 6810 | 0 |
| 6811 | 0 |
| 6812 | 0 |
| 6813 | 0 |
| 6814 | 0 |
| 6815 | 0 |
| 6816 | 0 |
| 6817 | 0 |
| 6818 | 0 |
| 6819 | 1023 |
| 6820 | 1023 |
| 6821 | 1023 |
| 6822 | 1023 |
| 6823 | 1023 |
| 6824 | 1023 |
| 6825 | 1023 |
| 6826 | 1023 |
| 6827 | 1023 |
| 6828 | 1023 |
| 6829 | 1023 |
| 6830 | 1023 |
| 6831 | 1023 |
| 6832 | 1023 |
| 6833 | 1023 |
| 6834 | 1023 |
| 6835 | 1023 |
| 6836 | 1023 |
| 6837 | 1023 |
| 6838 | 1023 |
| 6839 | 1023 |
| 6840 | 1023 |
| 6841 | 1023 |
| 6842 | 1023 |
| 6843 | 1023 |
| 6844 | 1023 |
| 6845 | 1023 |
| 6846 | 1023 |
| 6847 | 1023 |
| 6848 | 1023 |
| 6849 | 1023 |
| 6850 | 1023 |
| 6851 | 1023 |
| 6852 | 1023 |
| 6853 | 1023 |
| 6854 | 1023 |
| 6855 | 1023 |
| 6856 | 1023 |
| 6857 | 0 |
| 6858 | 0 |
| 6859 | 0 |
| 6860 | 0 |
| 6861 | 0 |
| 6862 | 0 |
| 6863 | 0 |
| 6864 | 0 |
| 6865 | 0 |
| 6866 | 0 |
| 6867 | 0 |
| 6868 | 0 |
| 6869 | 0 |
| 6870 | 530 |
| 6871 | 1023 |
| 6872 | 1023 |
| 6873 | 1023 |
| 6874 | 1023 |
| 6875 | 1023 |
| 6876 | 1023 |
| 6877 | 1023 |
| 6878 | 1023 |
| 6879 | 1023 |
| 6880 | 1023 |
| 6881 | 1023 |
| 6882 | 1023 |
| 6883 | 1023 |
| 6884 | 1023 |
| 6885 | 1023 |
| 6886 | 1023 |
| 6887 | 1023 |
| 6888 | 1023 |
| 6889 | 1023 |
| 6890 | 1023 |
| 6891 | 1023 |
| 6892 | 1023 |
| 6893 | 1023 |
| 6894 | 1023 |
| 6895 | 1023 |
| 6896 | 1023 |
| 6897 | 1023 |
| 6898 | 1023 |
| 6899 | 1023 |
| 6900 | 1023 |
| 6901 | 1023 |
| 6902 | 1023 |
| 6903 | 1023 |
| 6904 | 1023 |
| 6905 | 1023 |
| 6906 | 1023 |
| 6907 | 1023 |
| 6908 | 0 |
| 6909 | 0 |
| 6910 | 0 |
| 6911 | 0 |
| 6912 | 0 |
| 6913 | 0 |
| 6914 | 0 |
| 6915 | 0 |
| 6916 | 0 |
| 6917 | 0 |
| 6918 | 0 |
| 6919 | 0 |
| 6920 | 0 |
| 6921 | 0 |
| 6922 | 1023 |
| 6923 | 1023 |
| 6924 | 1023 |
| 6925 | 1023 |
| 6926 | 1023 |
| 6927 | 1023 |
| 6928 | 1023 |
| 6929 | 1023 |
| 6930 | 1023 |
| 6931 | 1023 |
| 6932 | 1023 |
| 6933 | 1023 |
| 6934 | 1023 |
| 6935 | 1023 |
| 6936 | 1023 |
| 6937 | 1023 |
| 6938 | 1023 |
| 6939 | 1023 |
| 6940 | 1023 |
| 6941 | 1023 |
| 6942 | 1023 |
| 6943 | 1023 |
| 6944 | 1023 |
| 6945 | 1023 |
| 6946 | 1023 |
| 6947 | 1023 |
| 6948 | 1023 |
| 6949 | 1023 |
| 6950 | 1023 |
| 6951 | 1023 |
| 6952 | 1023 |
| 6953 | 1023 |
| 6954 | 1023 |
| 6955 | 1023 |
| 6956 | 1023 |
| 6957 | 1023 |
| 6958 | 1023 |
| 6959 | 1023 |
| 6960 | 0 |
| 6961 | 0 |
| 6962 | 0 |
| 6963 | 0 |
| 6964 | 0 |
| 6965 | 0 |
| 6966 | 0 |
| 6967 | 0 |
| 6968 | 0 |
| 6969 | 0 |
| 6970 | 0 |
| 6971 | 0 |
| 6972 | 0 |
| 6973 | 1023 |
| 6974 | 1023 |
| 6975 | 1023 |
| 6976 | 1023 |
| 6977 | 1023 |
| 6978 | 1023 |
| 6979 | 1023 |
| 6980 | 1023 |
| 6981 | 1023 |
| 6982 | 1023 |
| 6983 | 1023 |
| 6984 | 1023 |
| 6985 | 1023 |
| 6986 | 1023 |
| 6987 | 1023 |
| 6988 | 1023 |
| 6989 | 1023 |
| 6990 | 1023 |
| 6991 | 1023 |
| 6992 | 1023 |
| 6993 | 1023 |
| 6994 | 1023 |
| 6995 | 1023 |
| 6996 | 1023 |
| 6997 | 1023 |
| 6998 | 1023 |
| 6999 | 1023 |
| 7000 | 1023 |
| 7001 | 1023 |
| 7002 | 1023 |
| 7003 | 1023 |
| 7004 | 1023 |
| 7005 | 1023 |
| 7006 | 1023 |
| 7007 | 1023 |
| 7008 | 1023 |
| 7009 | 1023 |
| 7010 | 1023 |
| 7011 | 0 |
| 7012 | 0 |
| 7013 | 0 |
| 7014 | 0 |
| 7015 | 0 |
| 7016 | 0 |
| 7017 | 0 |
| 7018 | 0 |
| 7019 | 0 |
| 7020 | 0 |
| 7021 | 0 |
| 7022 | 0 |
| 7023 | 0 |
| 7024 | 1023 |
| 7025 | 1023 |
| 7026 | 1023 |
| 7027 | 1023 |
| 7028 | 1023 |
| 7029 | 1023 |
| 7030 | 1023 |
| 7031 | 1023 |
| 7032 | 1023 |
| 7033 | 1023 |
| 7034 | 1023 |
| 7035 | 1023 |
| 7036 | 1023 |
| 7037 | 1023 |
| 7038 | 1023 |
| 7039 | 1023 |
| 7040 | 1023 |
| 7041 | 1023 |
| 7042 | 1023 |
| 7043 | 1023 |
| 7044 | 1023 |
| 7045 | 1023 |
| 7046 | 1023 |
| 7047 | 1023 |
| 7048 | 1023 |
| 7049 | 1023 |
| 7050 | 1023 |
| 7051 | 1023 |
| 7052 | 1023 |
| 7053 | 1023 |
| 7054 | 1023 |
| 7055 | 1023 |
| 7056 | 1023 |
| 7057 | 1023 |
| 7058 | 1023 |
| 7059 | 1023 |
| 7060 | 1023 |
| 7061 | 1023 |
| 7062 | 0 |
| 7063 | 0 |
| 7064 | 0 |
| 7065 | 0 |
| 7066 | 0 |
| 7067 | 0 |
| 7068 | 0 |
| 7069 | 0 |
| 7070 | 0 |
| 7071 | 0 |
| 7072 | 0 |
| 7073 | 0 |
| 7074 | 0 |
| 7075 | 1023 |
| 7076 | 1023 |
| 7077 | 1023 |
| 7078 | 1023 |
| 7079 | 1023 |
| 7080 | 1023 |
| 7081 | 1023 |
| 7082 | 1023 |
| 7083 | 1023 |
| 7084 | 1023 |
| 7085 | 1023 |
| 7086 | 1023 |
| 7087 | 1023 |
| 7088 | 1023 |
| 7089 | 1023 |
| 7090 | 1023 |
| 7091 | 1023 |
| 7092 | 1023 |
| 7093 | 1023 |
| 7094 | 1023 |
| 7095 | 1023 |
| 7096 | 1023 |
| 7097 | 1023 |
| 7098 | 1023 |
| 7099 | 1023 |
| 7100 | 1023 |
| 7101 | 1023 |
| 7102 | 1023 |
| 7103 | 1023 |
| 7104 | 1023 |
| 7105 | 1023 |
| 7106 | 1023 |
| 7107 | 1023 |
| 7108 | 1023 |
| 7109 | 1023 |
| 7110 | 1023 |
| 7111 | 1023 |
| 7112 | 1023 |
| 7113 | 0 |
| 7114 | 0 |
| 7115 | 0 |
| 7116 | 0 |
| 7117 | 0 |
| 7118 | 0 |
| 7119 | 0 |
| 7120 | 0 |
| 7121 | 0 |
| 7122 | 0 |
| 7123 | 0 |
| 7124 | 0 |
| 7125 | 0 |
| 7126 | 1023 |
| 7127 | 1023 |
| 7128 | 1023 |
| 7129 | 1023 |
| 7130 | 1023 |
| 7131 | 1023 |
| 7132 | 1023 |
| 7133 | 1023 |
| 7134 | 1023 |
| 7135 | 1023 |
| 7136 | 1023 |
| 7137 | 1023 |
| 7138 | 1023 |
| 7139 | 1023 |
| 7140 | 1023 |
| 7141 | 1023 |
| 7142 | 1023 |
| 7143 | 1023 |
| 7144 | 1023 |
| 7145 | 1023 |
| 7146 | 1023 |
| 7147 | 1023 |
| 7148 | 1023 |
| 7149 | 1023 |
| 7150 | 1023 |
| 7151 | 1023 |
| 7152 | 1023 |
| 7153 | 1023 |
| 7154 | 1023 |
| 7155 | 1023 |
| 7156 | 1023 |
| 7157 | 1023 |
| 7158 | 1023 |
| 7159 | 1023 |
| 7160 | 1023 |
| 7161 | 1023 |
| 7162 | 1023 |
| 7163 | 1023 |
| 7164 | 0 |
| 7165 | 0 |
| 7166 | 0 |
| 7167 | 0 |
| 7168 | 0 |
| 7169 | 0 |
| 7170 | 0 |
| 7171 | 0 |
| 7172 | 0 |
| 7173 | 0 |
| 7174 | 0 |
| 7175 | 0 |
| 7176 | 0 |
| 7177 | 1023 |
| 7178 | 1023 |
| 7179 | 1023 |
| 7180 | 1023 |
| 7181 | 1023 |
| 7182 | 1023 |
| 7183 | 1023 |
| 7184 | 1023 |
| 7185 | 1023 |
| 7186 | 1023 |
| 7187 | 1023 |
| 7188 | 1023 |
| 7189 | 1023 |
| 7190 | 1023 |
| 7191 | 1023 |
| 7192 | 1023 |
| 7193 | 1023 |
| 7194 | 1023 |
| 7195 | 1023 |
| 7196 | 1023 |
| 7197 | 1023 |
| 7198 | 1023 |
| 7199 | 1023 |
| 7200 | 1023 |
| 7201 | 1023 |
| 7202 | 1023 |
| 7203 | 1023 |
| 7204 | 1023 |
| 7205 | 1023 |
| 7206 | 1023 |
| 7207 | 1023 |
| 7208 | 1023 |
| 7209 | 1023 |
| 7210 | 1023 |
| 7211 | 1023 |
| 7212 | 1023 |
| 7213 | 1023 |
| 7214 | 1023 |
| 7215 | 0 |
| 7216 | 0 |
| 7217 | 0 |
| 7218 | 0 |
| 7219 | 0 |
| 7220 | 0 |
| 7221 | 0 |
| 7222 | 0 |
| 7223 | 0 |
| 7224 | 0 |
| 7225 | 0 |
| 7226 | 0 |
| 7227 | 0 |
| 7228 | 1023 |
| 7229 | 1023 |
| 7230 | 1023 |
| 7231 | 1023 |
| 7232 | 1023 |
| 7233 | 1023 |
| 7234 | 1023 |
| 7235 | 1023 |
| 7236 | 1023 |
| 7237 | 1023 |
| 7238 | 1023 |
| 7239 | 1023 |
| 7240 | 1023 |
| 7241 | 1023 |
| 7242 | 1023 |
| 7243 | 1023 |
| 7244 | 1023 |
| 7245 | 1023 |
| 7246 | 1023 |
| 7247 | 1023 |
| 7248 | 1023 |
| 7249 | 1023 |
| 7250 | 1023 |
| 7251 | 1023 |
| 7252 | 1023 |
| 7253 | 1023 |
| 7254 | 1023 |
| 7255 | 1023 |
| 7256 | 1023 |
| 7257 | 1023 |
| 7258 | 1023 |
| 7259 | 1023 |
| 7260 | 1023 |
| 7261 | 1023 |
| 7262 | 1023 |
| 7263 | 1023 |
| 7264 | 1023 |
| 7265 | 1023 |
| 7266 | 0 |
| 7267 | 0 |
| 7268 | 0 |
| 7269 | 0 |
| 7270 | 0 |
| 7271 | 0 |
| 7272 | 0 |
| 7273 | 0 |
| 7274 | 0 |
| 7275 | 0 |
| 7276 | 0 |
| 7277 | 0 |
| 7278 | 0 |
| 7279 | 0 |
| 7280 | 1023 |
| 7281 | 1023 |
| 7282 | 1023 |
| 7283 | 1023 |
| 7284 | 1023 |
| 7285 | 1023 |
| 7286 | 1023 |
| 7287 | 1023 |
| 7288 | 1023 |
| 7289 | 1023 |
| 7290 | 1023 |
| 7291 | 1023 |
| 7292 | 1023 |
| 7293 | 1023 |
| 7294 | 1023 |
| 7295 | 1023 |
| 7296 | 1023 |
| 7297 | 1023 |
| 7298 | 1023 |
| 7299 | 1023 |
| 7300 | 1023 |
| 7301 | 1023 |
| 7302 | 1023 |
| 7303 | 1023 |
| 7304 | 1023 |
| 7305 | 1023 |
| 7306 | 1023 |
| 7307 | 1023 |
| 7308 | 1023 |
| 7309 | 1023 |
| 7310 | 1023 |
| 7311 | 1023 |
| 7312 | 1023 |
| 7313 | 1023 |
| 7314 | 1023 |
| 7315 | 1023 |
| 7316 | 1023 |
| 7317 | 0 |
| 7318 | 0 |
| 7319 | 0 |
| 7320 | 0 |
| 7321 | 0 |
| 7322 | 0 |
| 7323 | 0 |
| 7324 | 0 |
| 7325 | 0 |
| 7326 | 1 |
| 7327 | 0 |
| 7328 | 0 |
| 7329 | 0 |
| 7330 | 0 |
| 7331 | 1023 |
| 7332 | 1023 |
| 7333 | 1023 |
| 7334 | 1023 |
| 7335 | 1023 |
| 7336 | 1023 |
| 7337 | 1023 |
| 7338 | 1023 |
| 7339 | 1023 |
| 7340 | 1023 |
| 7341 | 1023 |
| 7342 | 1023 |
| 7343 | 1023 |
| 7344 | 1023 |
| 7345 | 1023 |
| 7346 | 1023 |
| 7347 | 1023 |
| 7348 | 1023 |
| 7349 | 1023 |
| 7350 | 1023 |
| 7351 | 1023 |
| 7352 | 1023 |
| 7353 | 1023 |
| 7354 | 1023 |
| 7355 | 1023 |
| 7356 | 1023 |
| 7357 | 1023 |
| 7358 | 1023 |
| 7359 | 1023 |
| 7360 | 1023 |
| 7361 | 1023 |
| 7362 | 1023 |
| 7363 | 1023 |
| 7364 | 1023 |
| 7365 | 1023 |
| 7366 | 1023 |
| 7367 | 1023 |
| 7368 | 1023 |
| 7369 | 0 |
| 7370 | 0 |
| 7371 | 0 |
| 7372 | 0 |
| 7373 | 0 |
| 7374 | 0 |
| 7375 | 0 |
| 7376 | 0 |
| 7377 | 0 |
| 7378 | 0 |
| 7379 | 0 |
| 7380 | 0 |
| 7381 | 1 |
| 7382 | 0 |
| 7383 | 1023 |
| 7384 | 1023 |
| 7385 | 1023 |
| 7386 | 1023 |
| 7387 | 1023 |
| 7388 | 1023 |
| 7389 | 1023 |
| 7390 | 1023 |
| 7391 | 1023 |
| 7392 | 1023 |
| 7393 | 1023 |
| 7394 | 1023 |
| 7395 | 1023 |
| 7396 | 1023 |
| 7397 | 1023 |
| 7398 | 1023 |
| 7399 | 1023 |
| 7400 | 1023 |
| 7401 | 1023 |
| 7402 | 1023 |
| 7403 | 1023 |
| 7404 | 1023 |
| 7405 | 1023 |
| 7406 | 1023 |
| 7407 | 1023 |
| 7408 | 1023 |
| 7409 | 1023 |
| 7410 | 1023 |
| 7411 | 1023 |
| 7412 | 1023 |
| 7413 | 1023 |
| 7414 | 1023 |
| 7415 | 1023 |
| 7416 | 1023 |
| 7417 | 1023 |
| 7418 | 1023 |
| 7419 | 1023 |
| 7420 | 0 |
| 7421 | 0 |
| 7422 | 0 |
| 7423 | 0 |
| 7424 | 0 |
| 7425 | 0 |
| 7426 | 0 |
| 7427 | 0 |
| 7428 | 0 |
| 7429 | 0 |
| 7430 | 0 |
| 7431 | 0 |
| 7432 | 0 |
| 7433 | 0 |
| 7434 | 0 |
| 7435 | 1023 |
| 7436 | 1023 |
| 7437 | 1023 |
| 7438 | 1023 |
| 7439 | 1023 |
| 7440 | 1023 |
| 7441 | 1023 |
| 7442 | 1023 |
| 7443 | 1023 |
| 7444 | 1023 |
| 7445 | 1023 |
| 7446 | 1023 |
| 7447 | 1023 |
| 7448 | 1023 |
| 7449 | 1023 |
| 7450 | 1023 |
| 7451 | 1023 |
| 7452 | 1023 |
| 7453 | 1023 |
| 7454 | 1023 |
| 7455 | 1023 |
| 7456 | 1023 |
| 7457 | 1023 |
| 7458 | 1023 |
| 7459 | 1023 |
| 7460 | 1023 |
| 7461 | 1023 |
| 7462 | 1023 |
| 7463 | 1023 |
| 7464 | 1023 |
| 7465 | 1023 |
| 7466 | 1023 |
| 7467 | 1023 |
| 7468 | 1023 |
| 7469 | 1023 |
| 7470 | 1023 |
| 7471 | 1023 |
| 7472 | 0 |
| 7473 | 0 |
| 7474 | 0 |
| 7475 | 0 |
| 7476 | 0 |
| 7477 | 0 |
| 7478 | 0 |
| 7479 | 0 |
| 7480 | 0 |
| 7481 | 0 |
| 7482 | 0 |
| 7483 | 0 |
| 7484 | 0 |
| 7485 | 0 |
| 7486 | 0 |
| 7487 | 1023 |
| 7488 | 1023 |
| 7489 | 1023 |
| 7490 | 1023 |
| 7491 | 1023 |
| 7492 | 1023 |
| 7493 | 1023 |
| 7494 | 1023 |
| 7495 | 1023 |
| 7496 | 1023 |
| 7497 | 1023 |
| 7498 | 1023 |
| 7499 | 1023 |
| 7500 | 1023 |
| 7501 | 1023 |
| 7502 | 1023 |
| 7503 | 1023 |
| 7504 | 1023 |
| 7505 | 1023 |
| 7506 | 1023 |
| 7507 | 1023 |
| 7508 | 1023 |
| 7509 | 1023 |
| 7510 | 1023 |
| 7511 | 1023 |
| 7512 | 1023 |
| 7513 | 1023 |
| 7514 | 1023 |
| 7515 | 1023 |
| 7516 | 1023 |
| 7517 | 1023 |
| 7518 | 1023 |
| 7519 | 1023 |
| 7520 | 1023 |
| 7521 | 1023 |
| 7522 | 1023 |
| 7523 | 1023 |
| 7524 | 0 |
| 7525 | 0 |
| 7526 | 0 |
| 7527 | 0 |
| 7528 | 1 |
| 7529 | 0 |
| 7530 | 0 |
| 7531 | 0 |
| 7532 | 0 |
| 7533 | 0 |
| 7534 | 0 |
| 7535 | 0 |
| 7536 | 0 |
| 7537 | 0 |
| 7538 | 0 |
| 7539 | 1023 |
| 7540 | 1023 |
| 7541 | 1023 |
| 7542 | 1023 |
| 7543 | 1023 |
| 7544 | 1023 |
| 7545 | 1023 |
| 7546 | 1023 |
| 7547 | 1023 |
| 7548 | 1023 |
| 7549 | 1023 |
| 7550 | 1023 |
| 7551 | 1023 |
| 7552 | 1023 |
| 7553 | 1023 |
| 7554 | 1023 |
| 7555 | 1023 |
| 7556 | 1023 |
| 7557 | 1023 |
| 7558 | 1023 |
| 7559 | 1023 |
| 7560 | 1023 |
| 7561 | 1023 |
| 7562 | 1023 |
| 7563 | 1023 |
| 7564 | 1023 |
| 7565 | 1023 |
| 7566 | 1023 |
| 7567 | 1023 |
| 7568 | 1023 |
| 7569 | 1023 |
| 7570 | 1023 |
| 7571 | 1023 |
| 7572 | 1023 |
| 7573 | 1023 |
| 7574 | 1023 |
| 7575 | 1023 |
| 7576 | 0 |
| 7577 | 0 |
| 7578 | 0 |
| 7579 | 0 |
| 7580 | 0 |
| 7581 | 0 |
| 7582 | 0 |
| 7583 | 0 |
| 7584 | 0 |
| 7585 | 0 |
| 7586 | 0 |
| 7587 | 0 |
| 7588 | 0 |
| 7589 | 0 |
| 7590 | 0 |
| 7591 | 1023 |
| 7592 | 1023 |
| 7593 | 1023 |
| 7594 | 1023 |
| 7595 | 1023 |
| 7596 | 1023 |
| 7597 | 1023 |
| 7598 | 1023 |
| 7599 | 1023 |
| 7600 | 1023 |
| 7601 | 1023 |
| 7602 | 1023 |
| 7603 | 1023 |
| 7604 | 1023 |
| 7605 | 1023 |
| 7606 | 1023 |
| 7607 | 1023 |
| 7608 | 1023 |
| 7609 | 1023 |
| 7610 | 1023 |
| 7611 | 1023 |
| 7612 | 1023 |
| 7613 | 1023 |
| 7614 | 1023 |
| 7615 | 1023 |
| 7616 | 1023 |
| 7617 | 1023 |
| 7618 | 1023 |
| 7619 | 1023 |
| 7620 | 1023 |
| 7621 | 1023 |
| 7622 | 1023 |
| 7623 | 1023 |
| 7624 | 1023 |
| 7625 | 1023 |
| 7626 | 1023 |
| 7627 | 1023 |
| 7628 | 1023 |
| 7629 | 0 |
| 7630 | 0 |
| 7631 | 0 |
| 7632 | 0 |
| 7633 | 0 |
| 7634 | 0 |
| 7635 | 0 |
| 7636 | 0 |
| 7637 | 0 |
| 7638 | 0 |
| 7639 | 0 |
| 7640 | 0 |
| 7641 | 0 |
| 7642 | 1023 |
| 7643 | 1023 |
| 7644 | 1023 |
| 7645 | 1023 |
| 7646 | 1023 |
| 7647 | 1023 |
| 7648 | 1023 |
| 7649 | 1023 |
| 7650 | 1023 |
| 7651 | 1023 |
| 7652 | 1023 |
| 7653 | 1023 |
| 7654 | 1023 |
| 7655 | 1023 |
| 7656 | 1023 |
| 7657 | 1023 |
| 7658 | 1023 |
| 7659 | 1023 |
| 7660 | 1023 |
| 7661 | 1023 |
| 7662 | 1023 |
| 7663 | 1023 |
| 7664 | 1023 |
| 7665 | 1023 |
| 7666 | 1023 |
| 7667 | 1023 |
| 7668 | 1023 |
| 7669 | 1023 |
| 7670 | 1023 |
| 7671 | 1023 |
| 7672 | 1023 |
| 7673 | 1023 |
| 7674 | 1023 |
| 7675 | 1023 |
| 7676 | 1023 |
| 7677 | 1023 |
| 7678 | 1023 |
| 7679 | 1023 |
| 7680 | 0 |
| 7681 | 0 |
| 7682 | 0 |
| 7683 | 0 |
| 7684 | 0 |
| 7685 | 0 |
| 7686 | 0 |
| 7687 | 1 |
| 7688 | 0 |
| 7689 | 0 |
| 7690 | 0 |
| 7691 | 0 |
| 7692 | 0 |
| 7693 | 1023 |
| 7694 | 1023 |
| 7695 | 1023 |
| 7696 | 1023 |
| 7697 | 1023 |
| 7698 | 1023 |
| 7699 | 1023 |
| 7700 | 1023 |
| 7701 | 1023 |
| 7702 | 1023 |
| 7703 | 1023 |
| 7704 | 1023 |
| 7705 | 1023 |
| 7706 | 1023 |
| 7707 | 1023 |
| 7708 | 1023 |
| 7709 | 1023 |
| 7710 | 1023 |
| 7711 | 1023 |
| 7712 | 1023 |
| 7713 | 1023 |
| 7714 | 1023 |
| 7715 | 1023 |
| 7716 | 1023 |
| 7717 | 1023 |
| 7718 | 1023 |
| 7719 | 1023 |
| 7720 | 1023 |
| 7721 | 1023 |
| 7722 | 1023 |
| 7723 | 1023 |
| 7724 | 1023 |
| 7725 | 1023 |
| 7726 | 1023 |
| 7727 | 1023 |
| 7728 | 1023 |
| 7729 | 1023 |
| 7730 | 1023 |
| 7731 | 0 |
| 7732 | 0 |
| 7733 | 0 |
| 7734 | 0 |
| 7735 | 0 |
| 7736 | 0 |
| 7737 | 0 |
| 7738 | 0 |
| 7739 | 0 |
| 7740 | 0 |
| 7741 | 0 |
| 7742 | 0 |
| 7743 | 0 |
| 7744 | 1023 |
| 7745 | 1023 |
| 7746 | 1023 |
| 7747 | 1023 |
| 7748 | 1023 |
| 7749 | 1023 |
| 7750 | 1023 |
| 7751 | 1023 |
| 7752 | 1023 |
| 7753 | 1023 |
| 7754 | 1023 |
| 7755 | 1023 |
| 7756 | 1023 |
| 7757 | 1023 |
| 7758 | 1023 |
| 7759 | 1023 |
| 7760 | 1023 |
| 7761 | 1023 |
| 7762 | 1023 |
| 7763 | 1023 |
| 7764 | 1023 |
| 7765 | 1023 |
| 7766 | 1023 |
| 7767 | 1023 |
| 7768 | 1023 |
| 7769 | 1023 |
| 7770 | 1023 |
| 7771 | 1023 |
| 7772 | 1023 |
| 7773 | 1023 |
| 7774 | 1023 |
| 7775 | 1023 |
| 7776 | 1023 |
| 7777 | 1023 |
| 7778 | 1023 |
| 7779 | 1023 |
| 7780 | 1023 |
| 7781 | 1023 |
| 7782 | 0 |
| 7783 | 0 |
| 7784 | 0 |
| 7785 | 0 |
| 7786 | 0 |
| 7787 | 0 |
| 7788 | 0 |
| 7789 | 0 |
| 7790 | 0 |
| 7791 | 1 |
| 7792 | 0 |
| 7793 | 0 |
| 7794 | 0 |
| 7795 | 1023 |
| 7796 | 1023 |
| 7797 | 1023 |
| 7798 | 1023 |
| 7799 | 1023 |
| 7800 | 1023 |
| 7801 | 1023 |
| 7802 | 1023 |
| 7803 | 1023 |
| 7804 | 1023 |
| 7805 | 1023 |
| 7806 | 1023 |
| 7807 | 1023 |
| 7808 | 1023 |
| 7809 | 1023 |
| 7810 | 1023 |
| 7811 | 1023 |
| 7812 | 1023 |
| 7813 | 1023 |
| 7814 | 1023 |
| 7815 | 1023 |
| 7816 | 1023 |
| 7817 | 1023 |
| 7818 | 1023 |
| 7819 | 1023 |
| 7820 | 1023 |
| 7821 | 1023 |
| 7822 | 1023 |
| 7823 | 1023 |
| 7824 | 1023 |
| 7825 | 1023 |
| 7826 | 1023 |
| 7827 | 1023 |
| 7828 | 1023 |
| 7829 | 1023 |
| 7830 | 1023 |
| 7831 | 1023 |
| 7832 | 1023 |
| 7833 | 0 |
| 7834 | 0 |
| 7835 | 0 |
| 7836 | 0 |
| 7837 | 0 |
| 7838 | 0 |
| 7839 | 0 |
| 7840 | 0 |
| 7841 | 0 |
| 7842 | 0 |
| 7843 | 0 |
| 7844 | 0 |
| 7845 | 0 |
| 7846 | 1023 |
| 7847 | 1023 |
| 7848 | 1023 |
| 7849 | 1023 |
| 7850 | 1023 |
| 7851 | 1023 |
| 7852 | 1023 |
| 7853 | 1023 |
| 7854 | 1023 |
| 7855 | 1023 |
| 7856 | 1023 |
| 7857 | 1023 |
| 7858 | 1023 |
| 7859 | 1023 |
| 7860 | 1023 |
| 7861 | 1023 |
| 7862 | 1023 |
| 7863 | 1023 |
| 7864 | 1023 |
| 7865 | 1023 |
| 7866 | 1023 |
| 7867 | 1023 |
| 7868 | 1023 |
| 7869 | 1023 |
| 7870 | 1023 |
| 7871 | 1023 |
| 7872 | 1023 |
| 7873 | 1023 |
| 7874 | 1023 |
| 7875 | 1023 |
| 7876 | 1023 |
| 7877 | 1023 |
| 7878 | 1023 |
| 7879 | 1023 |
| 7880 | 1023 |
| 7881 | 1023 |
| 7882 | 1023 |
| 7883 | 1023 |
| 7884 | 0 |
| 7885 | 0 |
| 7886 | 0 |
| 7887 | 0 |
| 7888 | 0 |
| 7889 | 0 |
| 7890 | 0 |
| 7891 | 0 |
| 7892 | 0 |
| 7893 | 0 |
| 7894 | 0 |
| 7895 | 0 |
| 7896 | 0 |
| 7897 | 0 |
| 7898 | 1023 |
| 7899 | 1023 |
| 7900 | 1023 |
| 7901 | 1023 |
| 7902 | 1023 |
| 7903 | 1023 |
| 7904 | 1023 |
| 7905 | 1023 |
| 7906 | 1023 |
| 7907 | 1023 |
| 7908 | 1023 |
| 7909 | 1023 |
| 7910 | 1023 |
| 7911 | 1023 |
| 7912 | 1023 |
| 7913 | 1023 |
| 7914 | 1023 |
| 7915 | 1023 |
| 7916 | 1023 |
| 7917 | 1023 |
| 7918 | 1023 |
| 7919 | 1023 |
| 7920 | 1023 |
| 7921 | 1023 |
| 7922 | 1023 |
| 7923 | 1023 |
| 7924 | 1023 |
| 7925 | 1023 |
| 7926 | 1023 |
| 7927 | 1023 |
| 7928 | 1023 |
| 7929 | 1023 |
| 7930 | 1023 |
| 7931 | 1023 |
| 7932 | 1023 |
| 7933 | 1023 |
| 7934 | 1023 |
| 7935 | 0 |
| 7936 | 0 |
| 7937 | 0 |
| 7938 | 0 |
| 7939 | 0 |
| 7940 | 0 |
| 7941 | 0 |
| 7942 | 0 |
| 7943 | 0 |
| 7944 | 0 |
| 7945 | 0 |
| 7946 | 0 |
| 7947 | 0 |
| 7948 | 0 |
| 7949 | 1023 |
| 7950 | 1023 |
| 7951 | 1023 |
| 7952 | 1023 |
| 7953 | 1023 |
| 7954 | 1023 |
| 7955 | 1023 |
| 7956 | 1023 |
| 7957 | 1023 |
| 7958 | 1023 |
| 7959 | 1023 |
| 7960 | 1023 |
| 7961 | 1023 |
| 7962 | 1023 |
| 7963 | 1023 |
| 7964 | 1023 |
| 7965 | 1023 |
| 7966 | 1023 |
| 7967 | 1023 |
| 7968 | 1023 |
| 7969 | 1023 |
| 7970 | 1023 |
| 7971 | 1023 |
| 7972 | 1023 |
| 7973 | 1023 |
| 7974 | 1023 |
| 7975 | 1023 |
| 7976 | 1023 |
| 7977 | 1023 |
| 7978 | 1023 |
| 7979 | 1023 |
| 7980 | 1023 |
| 7981 | 1023 |
| 7982 | 1023 |
| 7983 | 1023 |
| 7984 | 1023 |
| 7985 | 1023 |
| 7986 | 1023 |
| 7987 | 0 |
| 7988 | 0 |
| 7989 | 0 |
| 7990 | 0 |
| 7991 | 0 |
| 7992 | 0 |
| 7993 | 0 |
| 7994 | 0 |
| 7995 | 0 |
| 7996 | 0 |
| 7997 | 0 |
| 7998 | 0 |
| 7999 | 0 |
| 8000 | 0 |
| 8001 | 1023 |
| 8002 | 1023 |
| 8003 | 1023 |
| 8004 | 1023 |
| 8005 | 1023 |
| 8006 | 1023 |
| 8007 | 1023 |
| 8008 | 1023 |
| 8009 | 1023 |
| 8010 | 1023 |
| 8011 | 1023 |
| 8012 | 1023 |
| 8013 | 1023 |
| 8014 | 1023 |
| 8015 | 1023 |
| 8016 | 1023 |
| 8017 | 1023 |
| 8018 | 1023 |
| 8019 | 1023 |
| 8020 | 1023 |
| 8021 | 1023 |
| 8022 | 1023 |
| 8023 | 1023 |
| 8024 | 1023 |
| 8025 | 1023 |
| 8026 | 1023 |
| 8027 | 1023 |
| 8028 | 1023 |
| 8029 | 1023 |
| 8030 | 1023 |
| 8031 | 1023 |
| 8032 | 1023 |
| 8033 | 1023 |
| 8034 | 1023 |
| 8035 | 1023 |
| 8036 | 1023 |
| 8037 | 1023 |
| 8038 | 0 |
| 8039 | 0 |
| 8040 | 0 |
| 8041 | 0 |
| 8042 | 0 |
| 8043 | 0 |
| 8044 | 0 |
| 8045 | 0 |
| 8046 | 0 |
| 8047 | 0 |
| 8048 | 0 |
| 8049 | 0 |
| 8050 | 0 |
| 8051 | 0 |
| 8052 | 0 |
| 8053 | 1023 |
| 8054 | 1023 |
| 8055 | 1023 |
| 8056 | 1023 |
| 8057 | 1023 |
| 8058 | 1023 |
| 8059 | 1023 |
| 8060 | 1023 |
| 8061 | 1023 |
| 8062 | 1023 |
| 8063 | 1023 |
| 8064 | 1023 |
| 8065 | 1023 |
| 8066 | 1023 |
| 8067 | 1023 |
| 8068 | 1023 |
| 8069 | 1023 |
| 8070 | 1023 |
| 8071 | 1023 |
| 8072 | 1023 |
| 8073 | 1023 |
| 8074 | 1023 |
| 8075 | 1023 |
| 8076 | 1023 |
| 8077 | 1023 |
| 8078 | 1023 |
| 8079 | 1023 |
| 8080 | 1023 |
| 8081 | 1023 |
| 8082 | 1023 |
| 8083 | 1023 |
| 8084 | 1023 |
| 8085 | 1023 |
| 8086 | 1023 |
| 8087 | 1023 |
| 8088 | 1023 |
| 8089 | 1023 |
| 8090 | 0 |
| 8091 | 0 |
| 8092 | 0 |
| 8093 | 0 |
| 8094 | 0 |
| 8095 | 0 |
| 8096 | 0 |
| 8097 | 0 |
| 8098 | 0 |
| 8099 | 0 |
| 8100 | 0 |
| 8101 | 0 |
| 8102 | 0 |
| 8103 | 0 |
| 8104 | 0 |
| 8105 | 1023 |
| 8106 | 1023 |
| 8107 | 1023 |
| 8108 | 1023 |
| 8109 | 1023 |
| 8110 | 1023 |
| 8111 | 1023 |
| 8112 | 1023 |
| 8113 | 1023 |
| 8114 | 1023 |
| 8115 | 1023 |
| 8116 | 1023 |
| 8117 | 1023 |
| 8118 | 1023 |
| 8119 | 1023 |
| 8120 | 1023 |
| 8121 | 1023 |
| 8122 | 1023 |
| 8123 | 1023 |
| 8124 | 1023 |
| 8125 | 1023 |
| 8126 | 1023 |
| 8127 | 1023 |
| 8128 | 1023 |
| 8129 | 1023 |
| 8130 | 1023 |
| 8131 | 1023 |
| 8132 | 1023 |
| 8133 | 1023 |
| 8134 | 1023 |
| 8135 | 1023 |
| 8136 | 1023 |
| 8137 | 1023 |
| 8138 | 1023 |
| 8139 | 1023 |
| 8140 | 1023 |
| 8141 | 1023 |
| 8142 | 0 |
| 8143 | 0 |
| 8144 | 0 |
| 8145 | 0 |
| 8146 | 0 |
| 8147 | 0 |
| 8148 | 0 |
| 8149 | 0 |
| 8150 | 0 |
| 8151 | 0 |
| 8152 | 0 |
| 8153 | 0 |
| 8154 | 0 |
| 8155 | 1 |
| 8156 | 0 |
| 8157 | 1023 |
| 8158 | 1023 |
| 8159 | 1023 |
| 8160 | 1023 |
| 8161 | 1023 |
| 8162 | 1023 |
| 8163 | 1023 |
| 8164 | 1023 |
| 8165 | 1023 |
| 8166 | 1023 |
| 8167 | 1023 |
| 8168 | 1023 |
| 8169 | 1023 |
| 8170 | 1023 |
| 8171 | 1023 |
| 8172 | 1023 |
| 8173 | 1023 |
| 8174 | 1023 |
| 8175 | 1023 |
| 8176 | 1023 |
| 8177 | 1023 |
| 8178 | 1023 |
| 8179 | 1023 |
| 8180 | 1023 |
| 8181 | 1023 |
| 8182 | 1023 |
| 8183 | 1023 |
| 8184 | 1023 |
| 8185 | 1023 |
| 8186 | 1023 |
| 8187 | 1023 |
| 8188 | 1023 |
| 8189 | 1023 |
| 8190 | 1023 |
| 8191 | 1023 |
| 8192 | 1023 |
| 8193 | 1023 |
| 8194 | 1023 |
| 8195 | 0 |
| 8196 | 1 |
| 8197 | 2 |
| 8198 | 0 |
| 8199 | 0 |
| 8200 | 0 |
| 8201 | 0 |
| 8202 | 0 |
| 8203 | 0 |
| 8204 | 0 |
| 8205 | 0 |
| 8206 | 0 |
| 8207 | 0 |
| 8208 | 1023 |
| 8209 | 1023 |
| 8210 | 1023 |
| 8211 | 1023 |
| 8212 | 1023 |
| 8213 | 1023 |
| 8214 | 1023 |
| 8215 | 1023 |
| 8216 | 1023 |
| 8217 | 1023 |
| 8218 | 1023 |
| 8219 | 1023 |
| 8220 | 1023 |
| 8221 | 1023 |
| 8222 | 1023 |
| 8223 | 1023 |
| 8224 | 1023 |
| 8225 | 1023 |
| 8226 | 1023 |
| 8227 | 1023 |
| 8228 | 1023 |
| 8229 | 1023 |
| 8230 | 1023 |
| 8231 | 1023 |
| 8232 | 1023 |
| 8233 | 1023 |
| 8234 | 1023 |
| 8235 | 1023 |
| 8236 | 1023 |
| 8237 | 1023 |
| 8238 | 1023 |
| 8239 | 1023 |
| 8240 | 1023 |
| 8241 | 1023 |
| 8242 | 1023 |
| 8243 | 1023 |
| 8244 | 1023 |
| 8245 | 1023 |
| 8246 | 0 |
| 8247 | 0 |
| 8248 | 0 |
| 8249 | 0 |
| 8250 | 0 |
| 8251 | 0 |
| 8252 | 0 |
| 8253 | 0 |
| 8254 | 0 |
| 8255 | 0 |
| 8256 | 0 |
| 8257 | 0 |
| 8258 | 0 |
| 8259 | 1023 |
| 8260 | 1023 |
| 8261 | 1023 |
| 8262 | 1023 |
| 8263 | 1023 |
| 8264 | 1023 |
| 8265 | 1023 |
| 8266 | 1023 |
| 8267 | 1023 |
| 8268 | 1023 |
| 8269 | 1023 |
| 8270 | 1023 |
| 8271 | 1023 |
| 8272 | 1023 |
| 8273 | 1023 |
| 8274 | 1023 |
| 8275 | 1023 |
| 8276 | 1023 |
| 8277 | 1023 |
| 8278 | 1023 |
| 8279 | 1023 |
| 8280 | 1023 |
| 8281 | 1023 |
| 8282 | 1023 |
| 8283 | 1023 |
| 8284 | 1023 |
| 8285 | 1023 |
| 8286 | 1023 |
| 8287 | 1023 |
| 8288 | 1023 |
| 8289 | 1023 |
| 8290 | 1023 |
| 8291 | 1023 |
| 8292 | 1023 |
| 8293 | 1023 |
| 8294 | 1023 |
| 8295 | 1023 |
| 8296 | 1023 |
| 8297 | 0 |
| 8298 | 0 |
| 8299 | 0 |
| 8300 | 0 |
| 8301 | 1 |
| 8302 | 0 |
| 8303 | 0 |
| 8304 | 0 |
| 8305 | 0 |
| 8306 | 0 |
| 8307 | 0 |
| 8308 | 0 |
| 8309 | 0 |
| 8310 | 1023 |
| 8311 | 1023 |
| 8312 | 1023 |
| 8313 | 1023 |
| 8314 | 1023 |
| 8315 | 1023 |
| 8316 | 1023 |
| 8317 | 1023 |
| 8318 | 1023 |
| 8319 | 1023 |
| 8320 | 1023 |
| 8321 | 1023 |
| 8322 | 1023 |
| 8323 | 1023 |
| 8324 | 1023 |
| 8325 | 1023 |
| 8326 | 1023 |
| 8327 | 1023 |
| 8328 | 1023 |
| 8329 | 1023 |
| 8330 | 1023 |
| 8331 | 1023 |
| 8332 | 1023 |
| 8333 | 1023 |
| 8334 | 1023 |
| 8335 | 1023 |
| 8336 | 1023 |
| 8337 | 1023 |
| 8338 | 1023 |
| 8339 | 1023 |
| 8340 | 1023 |
| 8341 | 1023 |
| 8342 | 1023 |
| 8343 | 1023 |
| 8344 | 1023 |
| 8345 | 1023 |
| 8346 | 1023 |
| 8347 | 1023 |
| 8348 | 0 |
| 8349 | 0 |
| 8350 | 0 |
| 8351 | 0 |
| 8352 | 0 |
| 8353 | 0 |
| 8354 | 0 |
| 8355 | 0 |
| 8356 | 0 |
| 8357 | 0 |
| 8358 | 0 |
| 8359 | 0 |
| 8360 | 0 |
| 8361 | 1023 |
| 8362 | 1023 |
| 8363 | 1023 |
| 8364 | 1023 |
| 8365 | 1023 |
| 8366 | 1023 |
| 8367 | 1023 |
| 8368 | 1023 |
| 8369 | 1023 |
| 8370 | 1023 |
| 8371 | 1023 |
| 8372 | 1023 |
| 8373 | 1023 |
| 8374 | 1023 |
| 8375 | 1023 |
| 8376 | 1023 |
| 8377 | 1023 |
| 8378 | 1023 |
| 8379 | 1023 |
| 8380 | 1023 |
| 8381 | 1023 |
| 8382 | 1023 |
| 8383 | 1023 |
| 8384 | 1023 |
| 8385 | 1023 |
| 8386 | 1023 |
| 8387 | 1023 |
| 8388 | 1023 |
| 8389 | 1023 |
| 8390 | 1023 |
| 8391 | 1023 |
| 8392 | 1023 |
| 8393 | 1023 |
| 8394 | 1023 |
| 8395 | 1023 |
| 8396 | 1023 |
| 8397 | 1023 |
| 8398 | 1023 |
| 8399 | 0 |
| 8400 | 0 |
| 8401 | 0 |
| 8402 | 0 |
| 8403 | 0 |
| 8404 | 0 |
| 8405 | 0 |
| 8406 | 0 |
| 8407 | 0 |
| 8408 | 1 |
| 8409 | 1 |
| 8410 | 0 |
| 8411 | 0 |
| 8412 | 1023 |
| 8413 | 1023 |
| 8414 | 1023 |
| 8415 | 1023 |
| 8416 | 1023 |
| 8417 | 1023 |
| 8418 | 1023 |
| 8419 | 1023 |
| 8420 | 1023 |
| 8421 | 1023 |
| 8422 | 1023 |
| 8423 | 1023 |
| 8424 | 1023 |
| 8425 | 1023 |
| 8426 | 1023 |
| 8427 | 1023 |
| 8428 | 1023 |
| 8429 | 1023 |
| 8430 | 1023 |
| 8431 | 1023 |
| 8432 | 1023 |
| 8433 | 1023 |
| 8434 | 1023 |
| 8435 | 1023 |
| 8436 | 1023 |
| 8437 | 1023 |
| 8438 | 1023 |
| 8439 | 1023 |
| 8440 | 1023 |
| 8441 | 1023 |
| 8442 | 1023 |
| 8443 | 1023 |
| 8444 | 1023 |
| 8445 | 1023 |
| 8446 | 1023 |
| 8447 | 1023 |
| 8448 | 1023 |
| 8449 | 1023 |
| 8450 | 0 |
| 8451 | 0 |
| 8452 | 0 |
| 8453 | 0 |
| 8454 | 1 |
| 8455 | 0 |
| 8456 | 0 |
| 8457 | 0 |
| 8458 | 0 |
| 8459 | 0 |
| 8460 | 0 |
| 8461 | 0 |
| 8462 | 0 |
| 8463 | 1023 |
| 8464 | 1023 |
| 8465 | 1023 |
| 8466 | 1023 |
| 8467 | 1023 |
| 8468 | 1023 |
| 8469 | 1023 |
| 8470 | 1023 |
| 8471 | 1023 |
| 8472 | 1023 |
| 8473 | 1023 |
| 8474 | 1023 |
| 8475 | 1023 |
| 8476 | 1023 |
| 8477 | 1023 |
| 8478 | 1023 |
| 8479 | 1023 |
| 8480 | 1023 |
| 8481 | 1023 |
| 8482 | 1023 |
| 8483 | 1023 |
| 8484 | 1023 |
| 8485 | 1023 |
| 8486 | 1023 |
| 8487 | 1023 |
| 8488 | 1023 |
| 8489 | 1023 |
| 8490 | 1023 |
| 8491 | 1023 |
| 8492 | 1023 |
| 8493 | 1023 |
| 8494 | 1023 |
| 8495 | 1023 |
| 8496 | 1023 |
| 8497 | 1023 |
| 8498 | 1023 |
| 8499 | 1023 |
| 8500 | 1023 |
| 8501 | 0 |
| 8502 | 0 |
| 8503 | 0 |
| 8504 | 0 |
| 8505 | 0 |
| 8506 | 0 |
| 8507 | 0 |
| 8508 | 0 |
| 8509 | 0 |
| 8510 | 0 |
| 8511 | 0 |
| 8512 | 0 |
| 8513 | 0 |
| 8514 | 0 |
| 8515 | 1023 |
| 8516 | 1023 |
| 8517 | 1023 |
| 8518 | 1023 |
| 8519 | 1023 |
| 8520 | 1023 |
| 8521 | 1023 |
| 8522 | 1023 |
| 8523 | 1023 |
| 8524 | 1023 |
| 8525 | 1023 |
| 8526 | 1023 |
| 8527 | 1023 |
| 8528 | 1023 |
| 8529 | 1023 |
| 8530 | 1023 |
| 8531 | 1023 |
| 8532 | 1023 |
| 8533 | 1023 |
| 8534 | 1023 |
| 8535 | 1023 |
| 8536 | 1023 |
| 8537 | 1023 |
| 8538 | 1023 |
| 8539 | 1023 |
| 8540 | 1023 |
| 8541 | 1023 |
| 8542 | 1023 |
| 8543 | 1023 |
| 8544 | 1023 |
| 8545 | 1023 |
| 8546 | 1023 |
| 8547 | 1023 |
| 8548 | 1023 |
| 8549 | 1023 |
| 8550 | 1023 |
| 8551 | 1023 |
| 8552 | 0 |
| 8553 | 0 |
| 8554 | 0 |
| 8555 | 0 |
| 8556 | 0 |
| 8557 | 0 |
| 8558 | 0 |
| 8559 | 0 |
| 8560 | 0 |
| 8561 | 0 |
| 8562 | 0 |
| 8563 | 0 |
| 8564 | 0 |
| 8565 | 0 |
| 8566 | 1023 |
| 8567 | 1023 |
| 8568 | 1023 |
| 8569 | 1023 |
| 8570 | 1023 |
| 8571 | 1023 |
| 8572 | 1023 |
| 8573 | 1023 |
| 8574 | 1023 |
| 8575 | 1023 |
| 8576 | 1023 |
| 8577 | 1023 |
| 8578 | 1023 |
| 8579 | 1023 |
| 8580 | 1023 |
| 8581 | 1023 |
| 8582 | 1023 |
| 8583 | 1023 |
| 8584 | 1023 |
| 8585 | 1023 |
| 8586 | 1023 |
| 8587 | 1023 |
| 8588 | 1023 |
| 8589 | 1023 |
| 8590 | 1023 |
| 8591 | 1023 |
| 8592 | 1023 |
| 8593 | 1023 |
| 8594 | 1023 |
| 8595 | 1023 |
| 8596 | 1023 |
| 8597 | 1023 |
| 8598 | 1023 |
| 8599 | 1023 |
| 8600 | 1023 |
| 8601 | 1023 |
| 8602 | 1023 |
| 8603 | 1023 |
| 8604 | 0 |
| 8605 | 0 |
| 8606 | 0 |
| 8607 | 0 |
| 8608 | 1 |
| 8609 | 0 |
| 8610 | 0 |
| 8611 | 0 |
| 8612 | 0 |
| 8613 | 0 |
| 8614 | 0 |
| 8615 | 1 |
| 8616 | 0 |
| 8617 | 0 |
| 8618 | 1023 |
| 8619 | 1023 |
| 8620 | 1023 |
| 8621 | 1023 |
| 8622 | 1023 |
| 8623 | 1023 |
| 8624 | 1023 |
| 8625 | 1023 |
| 8626 | 1023 |
| 8627 | 1023 |
| 8628 | 1023 |
| 8629 | 1023 |
| 8630 | 1023 |
| 8631 | 1023 |
| 8632 | 1023 |
| 8633 | 1023 |
| 8634 | 1023 |
| 8635 | 1023 |
| 8636 | 1023 |
| 8637 | 1023 |
| 8638 | 1023 |
| 8639 | 1023 |
| 8640 | 1023 |
| 8641 | 1023 |
| 8642 | 1023 |
| 8643 | 1023 |
| 8644 | 1023 |
| 8645 | 1023 |
| 8646 | 1023 |
| 8647 | 1023 |
| 8648 | 1023 |
| 8649 | 1023 |
| 8650 | 1023 |
| 8651 | 1023 |
| 8652 | 1023 |
| 8653 | 1023 |
| 8654 | 1023 |
| 8655 | 0 |
| 8656 | 0 |
| 8657 | 0 |
| 8658 | 0 |
| 8659 | 0 |
| 8660 | 0 |
| 8661 | 0 |
| 8662 | 0 |
| 8663 | 0 |
| 8664 | 0 |
| 8665 | 0 |
| 8666 | 0 |
| 8667 | 0 |
| 8668 | 0 |
| 8669 | 0 |
| 8670 | 1023 |
| 8671 | 1023 |
| 8672 | 1023 |
| 8673 | 1023 |
| 8674 | 1023 |
| 8675 | 1023 |
| 8676 | 1023 |
| 8677 | 1023 |
| 8678 | 1023 |
| 8679 | 1023 |
| 8680 | 1023 |
| 8681 | 1023 |
| 8682 | 1023 |
| 8683 | 1023 |
| 8684 | 1023 |
| 8685 | 1023 |
| 8686 | 1023 |
| 8687 | 1023 |
| 8688 | 1023 |
| 8689 | 1023 |
| 8690 | 1023 |
| 8691 | 1023 |
| 8692 | 1023 |
| 8693 | 1023 |
| 8694 | 1023 |
| 8695 | 1023 |
| 8696 | 1023 |
| 8697 | 1023 |
| 8698 | 1023 |
| 8699 | 1023 |
| 8700 | 1023 |
| 8701 | 1023 |
| 8702 | 1023 |
| 8703 | 1023 |
| 8704 | 1023 |
| 8705 | 1023 |
| 8706 | 1023 |
| 8707 | 0 |
| 8708 | 0 |
| 8709 | 0 |
| 8710 | 0 |
| 8711 | 0 |
| 8712 | 0 |
| 8713 | 0 |
| 8714 | 0 |
| 8715 | 0 |
| 8716 | 0 |
| 8717 | 0 |
| 8718 | 0 |
| 8719 | 0 |
| 8720 | 0 |
| 8721 | 0 |
| 8722 | 1023 |
| 8723 | 1023 |
| 8724 | 1023 |
| 8725 | 1023 |
| 8726 | 1023 |
| 8727 | 1023 |
| 8728 | 1023 |
| 8729 | 1023 |
| 8730 | 1023 |
| 8731 | 1023 |
| 8732 | 1023 |
| 8733 | 1023 |
| 8734 | 1023 |
| 8735 | 1023 |
| 8736 | 1023 |
| 8737 | 1023 |
| 8738 | 1023 |
| 8739 | 1023 |
| 8740 | 1023 |
| 8741 | 1023 |
| 8742 | 1023 |
| 8743 | 1023 |
| 8744 | 1023 |
| 8745 | 1023 |
| 8746 | 1023 |
| 8747 | 1023 |
| 8748 | 1023 |
| 8749 | 1023 |
| 8750 | 1023 |
| 8751 | 1023 |
| 8752 | 1023 |
| 8753 | 1023 |
| 8754 | 1023 |
| 8755 | 1023 |
| 8756 | 1023 |
| 8757 | 1023 |
| 8758 | 1023 |
| 8759 | 0 |
| 8760 | 0 |
| 8761 | 0 |
| 8762 | 0 |
| 8763 | 0 |
| 8764 | 0 |
| 8765 | 0 |
| 8766 | 0 |
| 8767 | 0 |
| 8768 | 0 |
| 8769 | 0 |
| 8770 | 0 |
| 8771 | 0 |
| 8772 | 0 |
| 8773 | 0 |
| 8774 | 1023 |
| 8775 | 1023 |
| 8776 | 1023 |
| 8777 | 1023 |
| 8778 | 1023 |
| 8779 | 1023 |
| 8780 | 1023 |
| 8781 | 1023 |
| 8782 | 1023 |
| 8783 | 1023 |
| 8784 | 1023 |
| 8785 | 1023 |
| 8786 | 1023 |
| 8787 | 1023 |
| 8788 | 1023 |
| 8789 | 1023 |
| 8790 | 1023 |
| 8791 | 1023 |
| 8792 | 1023 |
| 8793 | 1023 |
| 8794 | 1023 |
| 8795 | 1023 |
| 8796 | 1023 |
| 8797 | 1023 |
| 8798 | 1023 |
| 8799 | 1023 |
| 8800 | 1023 |
| 8801 | 1023 |
| 8802 | 1023 |
| 8803 | 1023 |
| 8804 | 1023 |
| 8805 | 1023 |
| 8806 | 1023 |
| 8807 | 1023 |
| 8808 | 1023 |
| 8809 | 1023 |
| 8810 | 1023 |
| 8811 | 1023 |
| 8812 | 0 |
| 8813 | 0 |
| 8814 | 0 |
| 8815 | 0 |
| 8816 | 0 |
| 8817 | 0 |
| 8818 | 0 |
| 8819 | 0 |
| 8820 | 0 |
| 8821 | 0 |
| 8822 | 0 |
| 8823 | 0 |
| 8824 | 0 |
| 8825 | 1023 |
| 8826 | 1023 |
| 8827 | 1023 |
| 8828 | 1023 |
| 8829 | 1023 |
| 8830 | 1023 |
| 8831 | 1023 |
| 8832 | 1023 |
| 8833 | 1023 |
| 8834 | 1023 |
| 8835 | 1023 |
| 8836 | 1023 |
| 8837 | 1023 |
| 8838 | 1023 |
| 8839 | 1023 |
| 8840 | 1023 |
| 8841 | 1023 |
| 8842 | 1023 |
| 8843 | 1023 |
| 8844 | 1023 |
| 8845 | 1023 |
| 8846 | 1023 |
| 8847 | 1023 |
| 8848 | 1023 |
| 8849 | 1023 |
| 8850 | 1023 |
| 8851 | 1023 |
| 8852 | 1023 |
| 8853 | 1023 |
| 8854 | 1023 |
| 8855 | 1023 |
| 8856 | 1023 |
| 8857 | 1023 |
| 8858 | 1023 |
| 8859 | 1023 |
| 8860 | 1023 |
| 8861 | 1023 |
| 8862 | 1023 |
| 8863 | 0 |
| 8864 | 0 |
| 8865 | 0 |
| 8866 | 0 |
| 8867 | 0 |
| 8868 | 0 |
| 8869 | 0 |
| 8870 | 0 |
| 8871 | 0 |
| 8872 | 0 |
| 8873 | 0 |
| 8874 | 0 |
| 8875 | 0 |
| 8876 | 1023 |
| 8877 | 1023 |
| 8878 | 1023 |
| 8879 | 1023 |
| 8880 | 1023 |
| 8881 | 1023 |
| 8882 | 1023 |
| 8883 | 1023 |
| 8884 | 1023 |
| 8885 | 1023 |
| 8886 | 1023 |
| 8887 | 1023 |
| 8888 | 1023 |
| 8889 | 1023 |
| 8890 | 1023 |
| 8891 | 1023 |
| 8892 | 1023 |
| 8893 | 1023 |
| 8894 | 1023 |
| 8895 | 1023 |
| 8896 | 1023 |
| 8897 | 1023 |
| 8898 | 1023 |
| 8899 | 1023 |
| 8900 | 1023 |
| 8901 | 1023 |
| 8902 | 1023 |
| 8903 | 1023 |
| 8904 | 1023 |
| 8905 | 1023 |
| 8906 | 1023 |
| 8907 | 1023 |
| 8908 | 1023 |
| 8909 | 1023 |
| 8910 | 1023 |
| 8911 | 1023 |
| 8912 | 1023 |
| 8913 | 1023 |
| 8914 | 0 |
| 8915 | 0 |
| 8916 | 0 |
| 8917 | 0 |
| 8918 | 0 |
| 8919 | 0 |
| 8920 | 0 |
| 8921 | 0 |
| 8922 | 0 |
| 8923 | 0 |
| 8924 | 0 |
| 8925 | 0 |
| 8926 | 0 |
| 8927 | 1023 |
| 8928 | 1023 |
| 8929 | 1023 |
| 8930 | 1023 |
| 8931 | 1023 |
| 8932 | 1023 |
| 8933 | 1023 |
| 8934 | 1023 |
| 8935 | 1023 |
| 8936 | 1023 |
| 8937 | 1023 |
| 8938 | 1023 |
| 8939 | 1023 |
| 8940 | 1023 |
| 8941 | 1023 |
| 8942 | 1023 |
| 8943 | 1023 |
| 8944 | 1023 |
| 8945 | 1023 |
| 8946 | 1023 |
| 8947 | 1023 |
| 8948 | 1023 |
| 8949 | 1023 |
| 8950 | 1023 |
| 8951 | 1023 |
| 8952 | 1023 |
| 8953 | 1023 |
| 8954 | 1023 |
| 8955 | 1023 |
| 8956 | 1023 |
| 8957 | 1023 |
| 8958 | 1023 |
| 8959 | 1023 |
| 8960 | 1023 |
| 8961 | 1023 |
| 8962 | 1023 |
| 8963 | 1023 |
| 8964 | 1023 |
| 8965 | 0 |
| 8966 | 0 |
| 8967 | 0 |
| 8968 | 0 |
| 8969 | 0 |
| 8970 | 0 |
| 8971 | 0 |
| 8972 | 0 |
| 8973 | 0 |
| 8974 | 0 |
| 8975 | 0 |
| 8976 | 0 |
| 8977 | 0 |
| 8978 | 1023 |
| 8979 | 1023 |
| 8980 | 1023 |
| 8981 | 1023 |
| 8982 | 1023 |
| 8983 | 1023 |
| 8984 | 1023 |
| 8985 | 1023 |
| 8986 | 1023 |
| 8987 | 1023 |
| 8988 | 1023 |
| 8989 | 1023 |
| 8990 | 1023 |
| 8991 | 1023 |
| 8992 | 1023 |
| 8993 | 1023 |
| 8994 | 1023 |
| 8995 | 1023 |
| 8996 | 1023 |
| 8997 | 1023 |
| 8998 | 1023 |
| 8999 | 1023 |
| 9000 | 1023 |
| 9001 | 1023 |
| 9002 | 1023 |
| 9003 | 1023 |
| 9004 | 1023 |
| 9005 | 1023 |
| 9006 | 1023 |
| 9007 | 1023 |
| 9008 | 1023 |
| 9009 | 1023 |
| 9010 | 1023 |
| 9011 | 1023 |
| 9012 | 1023 |
| 9013 | 1023 |
| 9014 | 1023 |
| 9015 | 1023 |
| 9016 | 0 |
| 9017 | 0 |
| 9018 | 0 |
| 9019 | 0 |
| 9020 | 0 |
| 9021 | 0 |
| 9022 | 0 |
| 9023 | 0 |
| 9024 | 0 |
| 9025 | 0 |
| 9026 | 0 |
| 9027 | 0 |
| 9028 | 0 |
| 9029 | 1023 |
| 9030 | 1023 |
| 9031 | 1023 |
| 9032 | 1023 |
| 9033 | 1023 |
| 9034 | 1023 |
| 9035 | 1023 |
| 9036 | 1023 |
| 9037 | 1023 |
| 9038 | 1023 |
| 9039 | 1023 |
| 9040 | 1023 |
| 9041 | 1023 |
| 9042 | 1023 |
| 9043 | 1023 |
| 9044 | 1023 |
| 9045 | 1023 |
| 9046 | 1023 |
| 9047 | 1023 |
| 9048 | 1023 |
| 9049 | 1023 |
| 9050 | 1023 |
| 9051 | 1023 |
| 9052 | 1023 |
| 9053 | 1023 |
| 9054 | 1023 |
| 9055 | 1023 |
| 9056 | 1023 |
| 9057 | 1023 |
| 9058 | 1023 |
| 9059 | 1023 |
| 9060 | 1023 |
| 9061 | 1023 |
| 9062 | 1023 |
| 9063 | 1023 |
| 9064 | 1023 |
| 9065 | 1023 |
| 9066 | 1023 |
| 9067 | 0 |
| 9068 | 0 |
| 9069 | 0 |
| 9070 | 0 |
| 9071 | 0 |
| 9072 | 0 |
| 9073 | 0 |
| 9074 | 0 |
| 9075 | 0 |
| 9076 | 0 |
| 9077 | 0 |
| 9078 | 0 |
| 9079 | 0 |
| 9080 | 1023 |
| 9081 | 1023 |
| 9082 | 1023 |
| 9083 | 1023 |
| 9084 | 1023 |
| 9085 | 1023 |
| 9086 | 1023 |
| 9087 | 1023 |
| 9088 | 1023 |
| 9089 | 1023 |
| 9090 | 1023 |
| 9091 | 1023 |
| 9092 | 1023 |
| 9093 | 1023 |
| 9094 | 1023 |
| 9095 | 1023 |
| 9096 | 1023 |
| 9097 | 1023 |
| 9098 | 1023 |
| 9099 | 1023 |
| 9100 | 1023 |
| 9101 | 1023 |
| 9102 | 1023 |
| 9103 | 1023 |
| 9104 | 1023 |
| 9105 | 1023 |
| 9106 | 1023 |
| 9107 | 1023 |
| 9108 | 1023 |
| 9109 | 1023 |
| 9110 | 1023 |
| 9111 | 1023 |
| 9112 | 1023 |
| 9113 | 1023 |
| 9114 | 1023 |
| 9115 | 1023 |
| 9116 | 1023 |
| 9117 | 1023 |
| 9118 | 0 |
| 9119 | 0 |
| 9120 | 0 |
| 9121 | 0 |
| 9122 | 0 |
| 9123 | 0 |
| 9124 | 0 |
| 9125 | 0 |
| 9126 | 0 |
| 9127 | 0 |
| 9128 | 0 |
| 9129 | 0 |
| 9130 | 0 |
| 9131 | 0 |
| 9132 | 1023 |
| 9133 | 1023 |
| 9134 | 1023 |
| 9135 | 1023 |
| 9136 | 1023 |
| 9137 | 1023 |
| 9138 | 1023 |
| 9139 | 1023 |
| 9140 | 1023 |
| 9141 | 1023 |
| 9142 | 1023 |
| 9143 | 1023 |
| 9144 | 1023 |
| 9145 | 1023 |
| 9146 | 1023 |
| 9147 | 1023 |
| 9148 | 1023 |
| 9149 | 1023 |
| 9150 | 1023 |
| 9151 | 1023 |
| 9152 | 1023 |
| 9153 | 1023 |
| 9154 | 1023 |
| 9155 | 1023 |
| 9156 | 1023 |
| 9157 | 1023 |
| 9158 | 1023 |
| 9159 | 1023 |
| 9160 | 1023 |
| 9161 | 1023 |
| 9162 | 1023 |
| 9163 | 1023 |
| 9164 | 1023 |
| 9165 | 1023 |
| 9166 | 1023 |
| 9167 | 1023 |
| 9168 | 1023 |
| 9169 | 0 |
| 9170 | 0 |
| 9171 | 0 |
| 9172 | 0 |
| 9173 | 0 |
| 9174 | 0 |
| 9175 | 1 |
| 9176 | 1 |
| 9177 | 0 |
| 9178 | 0 |
| 9179 | 1 |
| 9180 | 0 |
| 9181 | 0 |
| 9182 | 0 |
| 9183 | 1023 |
| 9184 | 1023 |
| 9185 | 1023 |
| 9186 | 1023 |
| 9187 | 1023 |
| 9188 | 1023 |
| 9189 | 1023 |
| 9190 | 1023 |
| 9191 | 1023 |
| 9192 | 1023 |
| 9193 | 1023 |
| 9194 | 1023 |
| 9195 | 1023 |
| 9196 | 1023 |
| 9197 | 1023 |
| 9198 | 1023 |
| 9199 | 1023 |
| 9200 | 1023 |
| 9201 | 1023 |
| 9202 | 1023 |
| 9203 | 1023 |
| 9204 | 1023 |
| 9205 | 1023 |
| 9206 | 1023 |
| 9207 | 1023 |
| 9208 | 1023 |
| 9209 | 1023 |
| 9210 | 1023 |
| 9211 | 1023 |
| 9212 | 1023 |
| 9213 | 1023 |
| 9214 | 1023 |
| 9215 | 1023 |
| 9216 | 1023 |
| 9217 | 1023 |
| 9218 | 1023 |
| 9219 | 1023 |
| 9220 | 1023 |
| 9221 | 0 |
| 9222 | 0 |
| 9223 | 0 |
| 9224 | 0 |
| 9225 | 0 |
| 9226 | 0 |
| 9227 | 0 |
| 9228 | 0 |
| 9229 | 0 |
| 9230 | 0 |
| 9231 | 0 |
| 9232 | 0 |
| 9233 | 0 |
| 9234 | 0 |
| 9235 | 1023 |
| 9236 | 1023 |
| 9237 | 1023 |
| 9238 | 1023 |
| 9239 | 1023 |
| 9240 | 1023 |
| 9241 | 1023 |
| 9242 | 1023 |
| 9243 | 1023 |
| 9244 | 1023 |
| 9245 | 1023 |
| 9246 | 1023 |
| 9247 | 1023 |
| 9248 | 1023 |
| 9249 | 1023 |
| 9250 | 1023 |
| 9251 | 1023 |
| 9252 | 1023 |
| 9253 | 1023 |
| 9254 | 1023 |
| 9255 | 1023 |
| 9256 | 1023 |
| 9257 | 1023 |
| 9258 | 1023 |
| 9259 | 1023 |
| 9260 | 1023 |
| 9261 | 1023 |
| 9262 | 1023 |
| 9263 | 1023 |
| 9264 | 1023 |
| 9265 | 1023 |
| 9266 | 1023 |
| 9267 | 1023 |
| 9268 | 1023 |
| 9269 | 1023 |
| 9270 | 1023 |
| 9271 | 1023 |
| 9272 | 0 |
| 9273 | 0 |
| 9274 | 0 |
| 9275 | 0 |
| 9276 | 0 |
| 9277 | 0 |
| 9278 | 0 |
| 9279 | 0 |
| 9280 | 0 |
| 9281 | 0 |
| 9282 | 0 |
| 9283 | 0 |
| 9284 | 0 |
| 9285 | 0 |
| 9286 | 0 |
| 9287 | 1023 |
| 9288 | 1023 |
| 9289 | 1023 |
| 9290 | 1023 |
| 9291 | 1023 |
| 9292 | 1023 |
| 9293 | 1023 |
| 9294 | 1023 |
| 9295 | 1023 |
| 9296 | 1023 |
| 9297 | 1023 |
| 9298 | 1023 |
| 9299 | 1023 |
| 9300 | 1023 |
| 9301 | 1023 |
| 9302 | 1023 |
| 9303 | 1023 |
| 9304 | 1023 |
| 9305 | 1023 |
| 9306 | 1023 |
| 9307 | 1023 |
| 9308 | 1023 |
| 9309 | 1023 |
| 9310 | 1023 |
| 9311 | 1023 |
| 9312 | 1023 |
| 9313 | 1023 |
| 9314 | 1023 |
| 9315 | 1023 |
| 9316 | 1023 |
| 9317 | 1023 |
| 9318 | 1023 |
| 9319 | 1023 |
| 9320 | 1023 |
| 9321 | 1023 |
| 9322 | 1023 |
| 9323 | 1023 |
| 9324 | 0 |
| 9325 | 0 |
| 9326 | 0 |
| 9327 | 0 |
| 9328 | 0 |
| 9329 | 0 |
| 9330 | 0 |
| 9331 | 0 |
| 9332 | 0 |
| 9333 | 0 |
| 9334 | 0 |
| 9335 | 0 |
| 9336 | 0 |
| 9337 | 0 |
| 9338 | 0 |
| 9339 | 1023 |
| 9340 | 1023 |
| 9341 | 1023 |
| 9342 | 1023 |
| 9343 | 1023 |
| 9344 | 1023 |
| 9345 | 1023 |
| 9346 | 1023 |
| 9347 | 1023 |
| 9348 | 1023 |
| 9349 | 1023 |
| 9350 | 1023 |
| 9351 | 1023 |
| 9352 | 1023 |
| 9353 | 1023 |
| 9354 | 1023 |
| 9355 | 1023 |
| 9356 | 1023 |
| 9357 | 1023 |
| 9358 | 1023 |
| 9359 | 1023 |
| 9360 | 1023 |
| 9361 | 1023 |
| 9362 | 1023 |
| 9363 | 1023 |
| 9364 | 1023 |
| 9365 | 1023 |
| 9366 | 1023 |
| 9367 | 1023 |
| 9368 | 1023 |
| 9369 | 1023 |
| 9370 | 1023 |
| 9371 | 1023 |
| 9372 | 1023 |
| 9373 | 1023 |
| 9374 | 1023 |
| 9375 | 1023 |
| 9376 | 0 |
| 9377 | 0 |
| 9378 | 0 |
| 9379 | 0 |
| 9380 | 0 |
| 9381 | 0 |
| 9382 | 0 |
| 9383 | 0 |
| 9384 | 0 |
| 9385 | 0 |
| 9386 | 0 |
| 9387 | 0 |
| 9388 | 0 |
| 9389 | 0 |
| 9390 | 0 |
| 9391 | 1023 |
| 9392 | 1023 |
| 9393 | 1023 |
| 9394 | 1023 |
| 9395 | 1023 |
| 9396 | 1023 |
| 9397 | 1023 |
| 9398 | 1023 |
| 9399 | 1023 |
| 9400 | 1023 |
| 9401 | 1023 |
| 9402 | 1023 |
| 9403 | 1023 |
| 9404 | 1023 |
| 9405 | 1023 |
| 9406 | 1023 |
| 9407 | 1023 |
| 9408 | 1023 |
| 9409 | 1023 |
| 9410 | 1023 |
| 9411 | 1023 |
| 9412 | 1023 |
| 9413 | 1023 |
| 9414 | 1023 |
| 9415 | 1023 |
| 9416 | 1023 |
| 9417 | 1023 |
| 9418 | 1023 |
| 9419 | 1023 |
| 9420 | 1023 |
| 9421 | 1023 |
| 9422 | 1023 |
| 9423 | 1023 |
| 9424 | 1023 |
| 9425 | 1023 |
| 9426 | 1023 |
| 9427 | 1023 |
| 9428 | 1 |
| 9429 | 1 |
| 9430 | 0 |
| 9431 | 0 |
| 9432 | 0 |
| 9433 | 0 |
| 9434 | 0 |
| 9435 | 0 |
| 9436 | 0 |
| 9437 | 0 |
| 9438 | 0 |
| 9439 | 0 |
| 9440 | 0 |
| 9441 | 0 |
| 9442 | 0 |
| 9443 | 1023 |
| 9444 | 1023 |
| 9445 | 1023 |
| 9446 | 1023 |
| 9447 | 1023 |
| 9448 | 1023 |
| 9449 | 1023 |
| 9450 | 1023 |
| 9451 | 1023 |
| 9452 | 1023 |
| 9453 | 1023 |
| 9454 | 1023 |
| 9455 | 1023 |
| 9456 | 1023 |
| 9457 | 1023 |
| 9458 | 1023 |
| 9459 | 1023 |
| 9460 | 1023 |
| 9461 | 1023 |
| 9462 | 1023 |
| 9463 | 1023 |
| 9464 | 1023 |
| 9465 | 1023 |
| 9466 | 1023 |
| 9467 | 1023 |
| 9468 | 1023 |
| 9469 | 1023 |
| 9470 | 1023 |
| 9471 | 1023 |
| 9472 | 1023 |
| 9473 | 1023 |
| 9474 | 1023 |
| 9475 | 1023 |
| 9476 | 1023 |
| 9477 | 1023 |
| 9478 | 1023 |
| 9479 | 1023 |
| 9480 | 1023 |
| 9481 | 0 |
| 9482 | 0 |
| 9483 | 0 |
| 9484 | 0 |
| 9485 | 0 |
| 9486 | 0 |
| 9487 | 0 |
| 9488 | 0 |
| 9489 | 0 |
| 9490 | 0 |
| 9491 | 0 |
| 9492 | 1 |
| 9493 | 0 |
| 9494 | 1023 |
| 9495 | 1023 |
| 9496 | 1023 |
| 9497 | 1023 |
| 9498 | 1023 |
| 9499 | 1023 |
| 9500 | 1023 |
| 9501 | 1023 |
| 9502 | 1023 |
| 9503 | 1023 |
| 9504 | 1023 |
| 9505 | 1023 |
| 9506 | 1023 |
| 9507 | 1023 |
| 9508 | 1023 |
| 9509 | 1023 |
| 9510 | 1023 |
| 9511 | 1023 |
| 9512 | 1023 |
| 9513 | 1023 |
| 9514 | 1023 |
| 9515 | 1023 |
| 9516 | 1023 |
| 9517 | 1023 |
| 9518 | 1023 |
| 9519 | 1023 |
| 9520 | 1023 |
| 9521 | 1023 |
| 9522 | 1023 |
| 9523 | 1023 |
| 9524 | 1023 |
| 9525 | 1023 |
| 9526 | 1023 |
| 9527 | 1023 |
| 9528 | 1023 |
| 9529 | 1023 |
| 9530 | 1023 |
| 9531 | 1023 |
| 9532 | 0 |
| 9533 | 0 |
| 9534 | 0 |
| 9535 | 1 |
| 9536 | 0 |
| 9537 | 0 |
| 9538 | 0 |
| 9539 | 0 |
| 9540 | 0 |
| 9541 | 0 |
| 9542 | 0 |
| 9543 | 0 |
| 9544 | 0 |
| 9545 | 1023 |
| 9546 | 1023 |
| 9547 | 1023 |
| 9548 | 1023 |
| 9549 | 1023 |
| 9550 | 1023 |
| 9551 | 1023 |
| 9552 | 1023 |
| 9553 | 1023 |
| 9554 | 1023 |
| 9555 | 1023 |
| 9556 | 1023 |
| 9557 | 1023 |
| 9558 | 1023 |
| 9559 | 1023 |
| 9560 | 1023 |
| 9561 | 1023 |
| 9562 | 1023 |
| 9563 | 1023 |
| 9564 | 1023 |
| 9565 | 1023 |
| 9566 | 1023 |
| 9567 | 1023 |
| 9568 | 1023 |
| 9569 | 1023 |
| 9570 | 1023 |
| 9571 | 1023 |
| 9572 | 1023 |
| 9573 | 1023 |
| 9574 | 1023 |
| 9575 | 1023 |
| 9576 | 1023 |
| 9577 | 1023 |
| 9578 | 1023 |
| 9579 | 1023 |
| 9580 | 1023 |
| 9581 | 1023 |
| 9582 | 1023 |
| 9583 | 0 |
| 9584 | 0 |
| 9585 | 0 |
| 9586 | 0 |
| 9587 | 0 |
| 9588 | 0 |
| 9589 | 0 |
| 9590 | 0 |
| 9591 | 0 |
| 9592 | 0 |
| 9593 | 0 |
| 9594 | 0 |
| 9595 | 0 |
| 9596 | 1023 |
| 9597 | 1023 |
| 9598 | 1023 |
| 9599 | 1023 |
| 9600 | 1023 |
| 9601 | 1023 |
| 9602 | 1023 |
| 9603 | 1023 |
| 9604 | 1023 |
| 9605 | 1023 |
| 9606 | 1023 |
| 9607 | 1023 |
| 9608 | 1023 |
| 9609 | 1023 |
| 9610 | 1023 |
| 9611 | 1023 |
| 9612 | 1023 |
| 9613 | 1023 |
| 9614 | 1023 |
| 9615 | 1023 |
| 9616 | 1023 |
| 9617 | 1023 |
| 9618 | 1023 |
| 9619 | 1023 |
| 9620 | 1023 |
| 9621 | 1023 |
| 9622 | 1023 |
| 9623 | 1023 |
| 9624 | 1023 |
| 9625 | 1023 |
| 9626 | 1023 |
| 9627 | 1023 |
| 9628 | 1023 |
| 9629 | 1023 |
| 9630 | 1023 |
| 9631 | 1023 |
| 9632 | 1023 |
| 9633 | 1023 |
| 9634 | 0 |
| 9635 | 0 |
| 9636 | 0 |
| 9637 | 0 |
| 9638 | 0 |
| 9639 | 0 |
| 9640 | 0 |
| 9641 | 0 |
| 9642 | 0 |
| 9643 | 0 |
| 9644 | 0 |
| 9645 | 0 |
| 9646 | 0 |
| 9647 | 1023 |
| 9648 | 1023 |
| 9649 | 1023 |
| 9650 | 1023 |
| 9651 | 1023 |
| 9652 | 1023 |
| 9653 | 1023 |
| 9654 | 1023 |
| 9655 | 1023 |
| 9656 | 1023 |
| 9657 | 1023 |
| 9658 | 1023 |
| 9659 | 1023 |
| 9660 | 1023 |
| 9661 | 1023 |
| 9662 | 1023 |
| 9663 | 1023 |
| 9664 | 1023 |
| 9665 | 1023 |
| 9666 | 1023 |
| 9667 | 1023 |
| 9668 | 1023 |
| 9669 | 1023 |
| 9670 | 1023 |
| 9671 | 1023 |
| 9672 | 1023 |
| 9673 | 1023 |
| 9674 | 1023 |
| 9675 | 1023 |
| 9676 | 1023 |
| 9677 | 1023 |
| 9678 | 1023 |
| 9679 | 1023 |
| 9680 | 1023 |
| 9681 | 1023 |
| 9682 | 1023 |
| 9683 | 1023 |
| 9684 | 1023 |
| 9685 | 0 |
| 9686 | 0 |
| 9687 | 0 |
| 9688 | 0 |
| 9689 | 0 |
| 9690 | 0 |
| 9691 | 0 |
| 9692 | 0 |
| 9693 | 0 |
| 9694 | 0 |
| 9695 | 0 |
| 9696 | 0 |
| 9697 | 0 |
| 9698 | 0 |
| 9699 | 1023 |
| 9700 | 1023 |
| 9701 | 1023 |
| 9702 | 1023 |
| 9703 | 1023 |
| 9704 | 1023 |
| 9705 | 1023 |
| 9706 | 1023 |
| 9707 | 1023 |
| 9708 | 1023 |
| 9709 | 1023 |
| 9710 | 1023 |
| 9711 | 1023 |
| 9712 | 1023 |
| 9713 | 1023 |
| 9714 | 1023 |
| 9715 | 1023 |
| 9716 | 1023 |
| 9717 | 1023 |
| 9718 | 1023 |
| 9719 | 1023 |
| 9720 | 1023 |
| 9721 | 1023 |
| 9722 | 1023 |
| 9723 | 1023 |
| 9724 | 1023 |
| 9725 | 1023 |
| 9726 | 1023 |
| 9727 | 1023 |
| 9728 | 1023 |
| 9729 | 1023 |
| 9730 | 1023 |
| 9731 | 1023 |
| 9732 | 1023 |
| 9733 | 1023 |
| 9734 | 1023 |
| 9735 | 1023 |
| 9736 | 0 |
| 9737 | 0 |
| 9738 | 0 |
| 9739 | 0 |
| 9740 | 0 |
| 9741 | 0 |
| 9742 | 0 |
| 9743 | 0 |
| 9744 | 0 |
| 9745 | 0 |
| 9746 | 0 |
| 9747 | 0 |
| 9748 | 0 |
| 9749 | 0 |
| 9750 | 1023 |
| 9751 | 1023 |
| 9752 | 1023 |
| 9753 | 1023 |
| 9754 | 1023 |
| 9755 | 1023 |
| 9756 | 1023 |
| 9757 | 1023 |
| 9758 | 1023 |
| 9759 | 1023 |
| 9760 | 1023 |
| 9761 | 1023 |
| 9762 | 1023 |
| 9763 | 1023 |
| 9764 | 1023 |
| 9765 | 1023 |
| 9766 | 1023 |
| 9767 | 1023 |
| 9768 | 1023 |
| 9769 | 1023 |
| 9770 | 1023 |
| 9771 | 1023 |
| 9772 | 1023 |
| 9773 | 1023 |
| 9774 | 1023 |
| 9775 | 1023 |
| 9776 | 1023 |
| 9777 | 1023 |
| 9778 | 1023 |
| 9779 | 1023 |
| 9780 | 1023 |
| 9781 | 1023 |
| 9782 | 1023 |
| 9783 | 1023 |
| 9784 | 1023 |
| 9785 | 1023 |
| 9786 | 1023 |
| 9787 | 1023 |
| 9788 | 0 |
| 9789 | 0 |
| 9790 | 0 |
| 9791 | 0 |
| 9792 | 0 |
| 9793 | 0 |
| 9794 | 0 |
| 9795 | 0 |
| 9796 | 0 |
| 9797 | 0 |
| 9798 | 0 |
| 9799 | 0 |
| 9800 | 0 |
| 9801 | 0 |
| 9802 | 1023 |
| 9803 | 1023 |
| 9804 | 1023 |
| 9805 | 1023 |
| 9806 | 1023 |
| 9807 | 1023 |
| 9808 | 1023 |
| 9809 | 1023 |
| 9810 | 1023 |
| 9811 | 1023 |
| 9812 | 1023 |
| 9813 | 1023 |
| 9814 | 1023 |
| 9815 | 1023 |
| 9816 | 1023 |
| 9817 | 1023 |
| 9818 | 1023 |
| 9819 | 1023 |
| 9820 | 1023 |
| 9821 | 1023 |
| 9822 | 1023 |
| 9823 | 1023 |
| 9824 | 1023 |
| 9825 | 1023 |
| 9826 | 1023 |
| 9827 | 1023 |
| 9828 | 1023 |
| 9829 | 1023 |
| 9830 | 1023 |
| 9831 | 1023 |
| 9832 | 1023 |
| 9833 | 1023 |
| 9834 | 1023 |
| 9835 | 1023 |
| 9836 | 1023 |
| 9837 | 1023 |
| 9838 | 1023 |
| 9839 | 0 |
| 9840 | 0 |
| 9841 | 0 |
| 9842 | 0 |
| 9843 | 0 |
| 9844 | 0 |
| 9845 | 0 |
| 9846 | 0 |
| 9847 | 0 |
| 9848 | 0 |
| 9849 | 0 |
| 9850 | 0 |
| 9851 | 0 |
| 9852 | 0 |
| 9853 | 1023 |
| 9854 | 1023 |
| 9855 | 1023 |
| 9856 | 1023 |
| 9857 | 1023 |
| 9858 | 1023 |
| 9859 | 1023 |
| 9860 | 1023 |
| 9861 | 1023 |
| 9862 | 1023 |
| 9863 | 1023 |
| 9864 | 1023 |
| 9865 | 1023 |
| 9866 | 1023 |
| 9867 | 1023 |
| 9868 | 1023 |
| 9869 | 1023 |
| 9870 | 1023 |
| 9871 | 1023 |
| 9872 | 1023 |
| 9873 | 1023 |
| 9874 | 1023 |
| 9875 | 1023 |
| 9876 | 1023 |
| 9877 | 1023 |
| 9878 | 1023 |
| 9879 | 1023 |
| 9880 | 1023 |
| 9881 | 1023 |
| 9882 | 1023 |
| 9883 | 1023 |
| 9884 | 1023 |
| 9885 | 1023 |
| 9886 | 1023 |
| 9887 | 1023 |
| 9888 | 1023 |
| 9889 | 1023 |
| 9890 | 1023 |
| 9891 | 0 |
| 9892 | 0 |
| 9893 | 0 |
| 9894 | 0 |
| 9895 | 0 |
| 9896 | 0 |
| 9897 | 0 |
| 9898 | 0 |
| 9899 | 0 |
| 9900 | 0 |
| 9901 | 0 |
| 9902 | 0 |
| 9903 | 0 |
| 9904 | 0 |
| 9905 | 1023 |
| 9906 | 1023 |
| 9907 | 1023 |
| 9908 | 1023 |
| 9909 | 1023 |
| 9910 | 1023 |
| 9911 | 1023 |
| 9912 | 1023 |
| 9913 | 1023 |
| 9914 | 1023 |
| 9915 | 1023 |
| 9916 | 1023 |
| 9917 | 1023 |
| 9918 | 1023 |
| 9919 | 1023 |
| 9920 | 1023 |
| 9921 | 1023 |
| 9922 | 1023 |
| 9923 | 1023 |
| 9924 | 1023 |
| 9925 | 1023 |
| 9926 | 1023 |
| 9927 | 1023 |
| 9928 | 1023 |
| 9929 | 1023 |
| 9930 | 1023 |
| 9931 | 1023 |
| 9932 | 1023 |
| 9933 | 1023 |
| 9934 | 1023 |
| 9935 | 1023 |
| 9936 | 1023 |
| 9937 | 1023 |
| 9938 | 1023 |
| 9939 | 1023 |
| 9940 | 1023 |
| 9941 | 1023 |
| 9942 | 0 |
| 9943 | 0 |
| 9944 | 0 |
| 9945 | 0 |
| 9946 | 0 |
| 9947 | 0 |
| 9948 | 0 |
| 9949 | 0 |
| 9950 | 0 |
| 9951 | 0 |
| 9952 | 0 |
| 9953 | 0 |
| 9954 | 0 |
| 9955 | 0 |
| 9956 | 0 |
| 9957 | 1023 |
| 9958 | 1023 |
| 9959 | 1023 |
| 9960 | 1023 |
| 9961 | 1023 |
| 9962 | 1023 |
| 9963 | 1023 |
| 9964 | 1023 |
| 9965 | 1023 |
| 9966 | 1023 |
| 9967 | 1023 |
| 9968 | 1023 |
| 9969 | 1023 |
| 9970 | 1023 |
| 9971 | 1023 |
| 9972 | 1023 |
| 9973 | 1023 |
| 9974 | 1023 |
| 9975 | 1023 |
| 9976 | 1023 |
| 9977 | 1023 |
| 9978 | 1023 |
| 9979 | 1023 |
| 9980 | 1023 |
| 9981 | 1023 |
| 9982 | 1023 |
| 9983 | 1023 |
| 9984 | 1023 |
| 9985 | 1023 |
| 9986 | 1023 |
| 9987 | 1023 |
| 9988 | 1023 |
| 9989 | 1023 |
| 9990 | 1023 |
| 9991 | 1023 |
| 9992 | 1023 |
| 9993 | 1023 |
| 9994 | 0 |
| 9995 | 0 |
| 9996 | 0 |
| 9997 | 0 |
| 9998 | 0 |
| 9999 | 0 |
| 10000 | 0 |
| 10001 | 0 |
| 10002 | 0 |
| 10003 | 0 |
| 10004 | 0 |
| 10005 | 0 |
| 10006 | 0 |
| 10007 | 0 |
| 10008 | 0 |
| 10009 | 1023 |
| 10010 | 1023 |
| 10011 | 1023 |
| 10012 | 1023 |
| 10013 | 1023 |
| 10014 | 1023 |
| 10015 | 1023 |
| 10016 | 1023 |
| 10017 | 1023 |
| 10018 | 1023 |
| 10019 | 1023 |
| 10020 | 1023 |
| 10021 | 1023 |
| 10022 | 1023 |
| 10023 | 1023 |
| 10024 | 1023 |
| 10025 | 1023 |
| 10026 | 1023 |
| 10027 | 1023 |
| 10028 | 1023 |
| 10029 | 1023 |
| 10030 | 1023 |
| 10031 | 1023 |
| 10032 | 1023 |
| 10033 | 1023 |
| 10034 | 1023 |
| 10035 | 1023 |
| 10036 | 1023 |
| 10037 | 1023 |
| 10038 | 1023 |
| 10039 | 1023 |
| 10040 | 1023 |
| 10041 | 1023 |
| 10042 | 1023 |
| 10043 | 1023 |
| 10044 | 1023 |
| 10045 | 1023 |
| 10046 | 1023 |
| 10047 | 0 |
| 10048 | 0 |
| 10049 | 0 |
| 10050 | 0 |
| 10051 | 0 |
| 10052 | 0 |
| 10053 | 0 |
| 10054 | 0 |
| 10055 | 0 |
| 10056 | 0 |
| 10057 | 0 |
| 10058 | 0 |
| 10059 | 0 |
| 10060 | 1023 |
| 10061 | 1023 |
| 10062 | 1023 |
| 10063 | 1023 |
| 10064 | 1023 |
| 10065 | 1023 |
| 10066 | 1023 |
| 10067 | 1023 |
| 10068 | 1023 |
| 10069 | 1023 |
| 10070 | 1023 |
| 10071 | 1023 |
| 10072 | 1023 |
| 10073 | 1023 |
| 10074 | 1023 |
| 10075 | 1023 |
| 10076 | 1023 |
| 10077 | 1023 |
| 10078 | 1023 |
| 10079 | 1023 |
| 10080 | 1023 |
| 10081 | 1023 |
| 10082 | 1023 |
| 10083 | 1023 |
| 10084 | 1023 |
| 10085 | 1023 |
| 10086 | 1023 |
| 10087 | 1023 |
| 10088 | 1023 |
| 10089 | 1023 |
| 10090 | 1023 |
| 10091 | 1023 |
| 10092 | 1023 |
| 10093 | 1023 |
| 10094 | 1023 |
| 10095 | 1023 |
| 10096 | 1023 |
| 10097 | 1023 |
| 10098 | 0 |
| 10099 | 0 |
| 10100 | 0 |
| 10101 | 0 |
| 10102 | 0 |
| 10103 | 0 |
| 10104 | 0 |
| 10105 | 0 |
| 10106 | 0 |
| 10107 | 0 |
| 10108 | 0 |
| 10109 | 0 |
| 10110 | 0 |
| 10111 | 1023 |
| 10112 | 1023 |
| 10113 | 1023 |
| 10114 | 1023 |
| 10115 | 1023 |
| 10116 | 1023 |
| 10117 | 1023 |
| 10118 | 1023 |
| 10119 | 1023 |
| 10120 | 1023 |
| 10121 | 1023 |
| 10122 | 1023 |
| 10123 | 1023 |
| 10124 | 1023 |
| 10125 | 1023 |
| 10126 | 1023 |
| 10127 | 1023 |
| 10128 | 1023 |
| 10129 | 1023 |
| 10130 | 1023 |
| 10131 | 1023 |
| 10132 | 1023 |
| 10133 | 1023 |
| 10134 | 1023 |
| 10135 | 1023 |
| 10136 | 1023 |
| 10137 | 1023 |
| 10138 | 1023 |
| 10139 | 1023 |
| 10140 | 1023 |
| 10141 | 1023 |
| 10142 | 1023 |
| 10143 | 1023 |
| 10144 | 1023 |
| 10145 | 1023 |
| 10146 | 1023 |
| 10147 | 1023 |
| 10148 | 1023 |
| 10149 | 0 |
| 10150 | 0 |
| 10151 | 0 |
| 10152 | 2 |
| 10153 | 1 |
| 10154 | 0 |
| 10155 | 0 |
| 10156 | 0 |
| 10157 | 0 |
| 10158 | 0 |
| 10159 | 0 |
| 10160 | 0 |
| 10161 | 0 |
| 10162 | 1023 |
| 10163 | 1023 |
| 10164 | 1023 |
| 10165 | 1023 |
| 10166 | 1023 |
| 10167 | 1023 |
| 10168 | 1023 |
| 10169 | 1023 |
| 10170 | 1023 |
| 10171 | 1023 |
| 10172 | 1023 |
| 10173 | 1023 |
| 10174 | 1023 |
| 10175 | 1023 |
| 10176 | 1023 |
| 10177 | 1023 |
| 10178 | 1023 |
| 10179 | 1023 |
| 10180 | 1023 |
| 10181 | 1023 |
| 10182 | 1023 |
| 10183 | 1023 |
| 10184 | 1023 |
| 10185 | 1023 |
| 10186 | 1023 |
| 10187 | 1023 |
| 10188 | 1023 |
| 10189 | 1023 |
| 10190 | 1023 |
| 10191 | 1023 |
| 10192 | 1023 |
| 10193 | 1023 |
| 10194 | 1023 |
| 10195 | 1023 |
| 10196 | 1023 |
| 10197 | 1023 |
| 10198 | 1023 |
| 10199 | 1023 |
| 10200 | 0 |
| 10201 | 0 |
| 10202 | 0 |
| 10203 | 0 |
| 10204 | 0 |
| 10205 | 0 |
| 10206 | 0 |
| 10207 | 0 |
| 10208 | 1 |
| 10209 | 0 |
| 10210 | 0 |
| 10211 | 0 |
| 10212 | 0 |
| 10213 | 1023 |
| 10214 | 1023 |
| 10215 | 1023 |
| 10216 | 1023 |
| 10217 | 1023 |
| 10218 | 1023 |
| 10219 | 1023 |
| 10220 | 1023 |
| 10221 | 1023 |
| 10222 | 1023 |
| 10223 | 1023 |
| 10224 | 1023 |
| 10225 | 1023 |
| 10226 | 1023 |
| 10227 | 1023 |
| 10228 | 1023 |
| 10229 | 1023 |
| 10230 | 1023 |
| 10231 | 1023 |
| 10232 | 1023 |
| 10233 | 1023 |
| 10234 | 1023 |
| 10235 | 1023 |
| 10236 | 1023 |
| 10237 | 1023 |
| 10238 | 1023 |
| 10239 | 1023 |
| 10240 | 1023 |
| 10241 | 1023 |
| 10242 | 1023 |
| 10243 | 1023 |
| 10244 | 1023 |
| 10245 | 1023 |
| 10246 | 1023 |
| 10247 | 1023 |
| 10248 | 1023 |
| 10249 | 1023 |
| 10250 | 1023 |
| 10251 | 0 |
| 10252 | 0 |
| 10253 | 0 |
| 10254 | 0 |
| 10255 | 0 |
| 10256 | 0 |
| 10257 | 0 |
| 10258 | 0 |
| 10259 | 0 |
| 10260 | 0 |
| 10261 | 0 |
| 10262 | 0 |
| 10263 | 0 |
| 10264 | 1023 |
| 10265 | 1023 |
| 10266 | 1023 |
| 10267 | 1023 |
| 10268 | 1023 |
| 10269 | 1023 |
| 10270 | 1023 |
| 10271 | 1023 |
| 10272 | 1023 |
| 10273 | 1023 |
| 10274 | 1023 |
| 10275 | 1023 |
| 10276 | 1023 |
| 10277 | 1023 |
| 10278 | 1023 |
| 10279 | 1023 |
| 10280 | 1023 |
| 10281 | 1023 |
| 10282 | 1023 |
| 10283 | 1023 |
| 10284 | 1023 |
| 10285 | 1023 |
| 10286 | 1023 |
| 10287 | 1023 |
| 10288 | 1023 |
| 10289 | 1023 |
| 10290 | 1023 |
| 10291 | 1023 |
| 10292 | 1023 |
| 10293 | 1023 |
| 10294 | 1023 |
| 10295 | 1023 |
| 10296 | 1023 |
| 10297 | 1023 |
| 10298 | 1023 |
| 10299 | 1023 |
| 10300 | 1023 |
| 10301 | 1023 |
| 10302 | 0 |
| 10303 | 0 |
| 10304 | 0 |
| 10305 | 0 |
| 10306 | 0 |
| 10307 | 0 |
| 10308 | 0 |
| 10309 | 0 |
| 10310 | 0 |
| 10311 | 0 |
| 10312 | 0 |
| 10313 | 0 |
| 10314 | 0 |
| 10315 | 1023 |
| 10316 | 1023 |
| 10317 | 1023 |
| 10318 | 1023 |
| 10319 | 1023 |
| 10320 | 1023 |
| 10321 | 1023 |
| 10322 | 1023 |
| 10323 | 1023 |
| 10324 | 1023 |
| 10325 | 1023 |
| 10326 | 1023 |
| 10327 | 1023 |
| 10328 | 1023 |
| 10329 | 1023 |
| 10330 | 1023 |
| 10331 | 1023 |
| 10332 | 1023 |
| 10333 | 1023 |
| 10334 | 1023 |
| 10335 | 1023 |
| 10336 | 1023 |
| 10337 | 1023 |
| 10338 | 1023 |
| 10339 | 1023 |
| 10340 | 1023 |
| 10341 | 1023 |
| 10342 | 1023 |
| 10343 | 1023 |
| 10344 | 1023 |
| 10345 | 1023 |
| 10346 | 1023 |
| 10347 | 1023 |
| 10348 | 1023 |
| 10349 | 1023 |
| 10350 | 1023 |
| 10351 | 1023 |
| 10352 | 1023 |
| 10353 | 0 |
| 10354 | 0 |
| 10355 | 0 |
| 10356 | 0 |
| 10357 | 0 |
| 10358 | 0 |
| 10359 | 0 |
| 10360 | 0 |
| 10361 | 0 |
| 10362 | 0 |
| 10363 | 0 |
| 10364 | 0 |
| 10365 | 0 |
| 10366 | 0 |
| 10367 | 1023 |
| 10368 | 1023 |
| 10369 | 1023 |
| 10370 | 1023 |
| 10371 | 1023 |
| 10372 | 1023 |
| 10373 | 1023 |
| 10374 | 1023 |
| 10375 | 1023 |
| 10376 | 1023 |
| 10377 | 1023 |
| 10378 | 1023 |
| 10379 | 1023 |
| 10380 | 1023 |
| 10381 | 1023 |
| 10382 | 1023 |
| 10383 | 1023 |
| 10384 | 1023 |
| 10385 | 1023 |
| 10386 | 1023 |
| 10387 | 1023 |
| 10388 | 1023 |
| 10389 | 1023 |
| 10390 | 1023 |
| 10391 | 1023 |
| 10392 | 1023 |
| 10393 | 1023 |
| 10394 | 1023 |
| 10395 | 1023 |
| 10396 | 1023 |
| 10397 | 1023 |
| 10398 | 1023 |
| 10399 | 1023 |
| 10400 | 1023 |
| 10401 | 1023 |
| 10402 | 1023 |
| 10403 | 1023 |
| 10404 | 0 |
| 10405 | 0 |
| 10406 | 0 |
| 10407 | 0 |
| 10408 | 0 |
| 10409 | 0 |
| 10410 | 0 |
| 10411 | 0 |
| 10412 | 0 |
| 10413 | 0 |
| 10414 | 0 |
| 10415 | 0 |
| 10416 | 0 |
| 10417 | 0 |
| 10418 | 1023 |
| 10419 | 1023 |
| 10420 | 1023 |
| 10421 | 1023 |
| 10422 | 1023 |
| 10423 | 1023 |
| 10424 | 1023 |
| 10425 | 1023 |
| 10426 | 1023 |
| 10427 | 1023 |
| 10428 | 1023 |
| 10429 | 1023 |
| 10430 | 1023 |
| 10431 | 1023 |
| 10432 | 1023 |
| 10433 | 1023 |
| 10434 | 1023 |
| 10435 | 1023 |
| 10436 | 1023 |
| 10437 | 1023 |
| 10438 | 1023 |
| 10439 | 1023 |
| 10440 | 1023 |
| 10441 | 1023 |
| 10442 | 1023 |
| 10443 | 1023 |
| 10444 | 1023 |
| 10445 | 1023 |
| 10446 | 1023 |
| 10447 | 1023 |
| 10448 | 1023 |
| 10449 | 1023 |
| 10450 | 1023 |
| 10451 | 1023 |
| 10452 | 1023 |
| 10453 | 1023 |
| 10454 | 1023 |
| 10455 | 1023 |
| 10456 | 0 |
| 10457 | 0 |
| 10458 | 0 |
| 10459 | 0 |
| 10460 | 0 |
| 10461 | 0 |
| 10462 | 0 |
| 10463 | 0 |
| 10464 | 0 |
| 10465 | 0 |
| 10466 | 0 |
| 10467 | 0 |
| 10468 | 0 |
| 10469 | 0 |
| 10470 | 1023 |
| 10471 | 1023 |
| 10472 | 1023 |
| 10473 | 1023 |
| 10474 | 1023 |
| 10475 | 1023 |
| 10476 | 1023 |
| 10477 | 1023 |
| 10478 | 1023 |
| 10479 | 1023 |
| 10480 | 1023 |
| 10481 | 1023 |
| 10482 | 1023 |
| 10483 | 1023 |
| 10484 | 1023 |
| 10485 | 1023 |
| 10486 | 1023 |
| 10487 | 1023 |
| 10488 | 1023 |
| 10489 | 1023 |
| 10490 | 1023 |
| 10491 | 1023 |
| 10492 | 1023 |
| 10493 | 1023 |
| 10494 | 1023 |
| 10495 | 1023 |
| 10496 | 1023 |
| 10497 | 1023 |
| 10498 | 1023 |
| 10499 | 1023 |
| 10500 | 1023 |
| 10501 | 1023 |
| 10502 | 1023 |
| 10503 | 1023 |
| 10504 | 1023 |
| 10505 | 1023 |
| 10506 | 1023 |
| 10507 | 0 |
| 10508 | 0 |
| 10509 | 0 |
| 10510 | 0 |
| 10511 | 0 |
| 10512 | 0 |
| 10513 | 0 |
| 10514 | 0 |
| 10515 | 0 |
| 10516 | 0 |
| 10517 | 0 |
| 10518 | 0 |
| 10519 | 0 |
| 10520 | 0 |
| 10521 | 0 |
| 10522 | 1023 |
| 10523 | 1023 |
| 10524 | 1023 |
| 10525 | 1023 |
| 10526 | 1023 |
| 10527 | 1023 |
| 10528 | 1023 |
| 10529 | 1023 |
| 10530 | 1023 |
| 10531 | 1023 |
| 10532 | 1023 |
| 10533 | 1023 |
| 10534 | 1023 |
| 10535 | 1023 |
| 10536 | 1023 |
| 10537 | 1023 |
| 10538 | 1023 |
| 10539 | 1023 |
| 10540 | 1023 |
| 10541 | 1023 |
| 10542 | 1023 |
| 10543 | 1023 |
| 10544 | 1023 |
| 10545 | 1023 |
| 10546 | 1023 |
| 10547 | 1023 |
| 10548 | 1023 |
| 10549 | 1023 |
| 10550 | 1023 |
| 10551 | 1023 |
| 10552 | 1023 |
| 10553 | 1023 |
| 10554 | 1023 |
| 10555 | 1023 |
| 10556 | 1023 |
| 10557 | 1023 |
| 10558 | 1023 |
| 10559 | 0 |
| 10560 | 0 |
| 10561 | 0 |
| 10562 | 0 |
| 10563 | 0 |
| 10564 | 0 |
| 10565 | 0 |
| 10566 | 0 |
| 10567 | 0 |
| 10568 | 0 |
| 10569 | 0 |
| 10570 | 0 |
| 10571 | 0 |
| 10572 | 0 |
| 10573 | 0 |
| 10574 | 1023 |
| 10575 | 1023 |
| 10576 | 1023 |
| 10577 | 1023 |
| 10578 | 1023 |
| 10579 | 1023 |
| 10580 | 1023 |
| 10581 | 1023 |
| 10582 | 1023 |
| 10583 | 1023 |
| 10584 | 1023 |
| 10585 | 1023 |
| 10586 | 1023 |
| 10587 | 1023 |
| 10588 | 1023 |
| 10589 | 1023 |
| 10590 | 1023 |
| 10591 | 1023 |
| 10592 | 1023 |
| 10593 | 1023 |
| 10594 | 1023 |
| 10595 | 1023 |
| 10596 | 1023 |
| 10597 | 1023 |
| 10598 | 1023 |
| 10599 | 1023 |
| 10600 | 1023 |
| 10601 | 1023 |
| 10602 | 1023 |
| 10603 | 1023 |
| 10604 | 1023 |
| 10605 | 1023 |
| 10606 | 1023 |
| 10607 | 1023 |
| 10608 | 1023 |
| 10609 | 1023 |
| 10610 | 1023 |
| 10611 | 1023 |
| 10612 | 0 |
| 10613 | 0 |
| 10614 | 0 |
| 10615 | 0 |
| 10616 | 0 |
| 10617 | 0 |
| 10618 | 0 |
| 10619 | 0 |
| 10620 | 0 |
| 10621 | 0 |
| 10622 | 0 |
| 10623 | 0 |
| 10624 | 0 |
| 10625 | 1023 |
| 10626 | 1023 |
| 10627 | 1023 |
| 10628 | 1023 |
| 10629 | 1023 |
| 10630 | 1023 |
| 10631 | 1023 |
| 10632 | 1023 |
| 10633 | 1023 |
| 10634 | 1023 |
| 10635 | 1023 |
| 10636 | 1023 |
| 10637 | 1023 |
| 10638 | 1023 |
| 10639 | 1023 |
| 10640 | 1023 |
| 10641 | 1023 |
| 10642 | 1023 |
| 10643 | 1023 |
| 10644 | 1023 |
| 10645 | 1023 |
| 10646 | 1023 |
| 10647 | 1023 |
| 10648 | 1023 |
| 10649 | 1023 |
| 10650 | 1023 |
| 10651 | 1023 |
| 10652 | 1023 |
| 10653 | 1023 |
| 10654 | 1023 |
| 10655 | 1023 |
| 10656 | 1023 |
| 10657 | 1023 |
| 10658 | 1023 |
| 10659 | 1023 |
| 10660 | 1023 |
| 10661 | 1023 |
| 10662 | 1023 |
| 10663 | 0 |
| 10664 | 0 |
| 10665 | 0 |
| 10666 | 0 |
| 10667 | 0 |
| 10668 | 0 |
| 10669 | 0 |
| 10670 | 0 |
| 10671 | 0 |
| 10672 | 0 |
| 10673 | 0 |
| 10674 | 0 |
| 10675 | 0 |
| 10676 | 1023 |
| 10677 | 1023 |
| 10678 | 1023 |
| 10679 | 1023 |
| 10680 | 1023 |
| 10681 | 1023 |
| 10682 | 1023 |
| 10683 | 1023 |
| 10684 | 1023 |
| 10685 | 1023 |
| 10686 | 1023 |
| 10687 | 1023 |
| 10688 | 1023 |
| 10689 | 1023 |
| 10690 | 1023 |
| 10691 | 1023 |
| 10692 | 1023 |
| 10693 | 1023 |
| 10694 | 1023 |
| 10695 | 1023 |
| 10696 | 1023 |
| 10697 | 1023 |
| 10698 | 1023 |
| 10699 | 1023 |
| 10700 | 1023 |
| 10701 | 1023 |
| 10702 | 1023 |
| 10703 | 1023 |
| 10704 | 1023 |
| 10705 | 1023 |
| 10706 | 1023 |
| 10707 | 1023 |
| 10708 | 1023 |
| 10709 | 1023 |
| 10710 | 1023 |
| 10711 | 1023 |
| 10712 | 1023 |
| 10713 | 1023 |
| 10714 | 0 |
| 10715 | 0 |
| 10716 | 0 |
| 10717 | 0 |
| 10718 | 0 |
| 10719 | 0 |
| 10720 | 0 |
| 10721 | 0 |
| 10722 | 0 |
| 10723 | 0 |
| 10724 | 0 |
| 10725 | 0 |
| 10726 | 0 |
| 10727 | 1023 |
| 10728 | 1023 |
| 10729 | 1023 |
| 10730 | 1023 |
| 10731 | 1023 |
| 10732 | 1023 |
| 10733 | 1023 |
| 10734 | 1023 |
| 10735 | 1023 |
| 10736 | 1023 |
| 10737 | 1023 |
| 10738 | 1023 |
| 10739 | 1023 |
| 10740 | 1023 |
| 10741 | 1023 |
| 10742 | 1023 |
| 10743 | 1023 |
| 10744 | 1023 |
| 10745 | 1023 |
| 10746 | 1023 |
| 10747 | 1023 |
| 10748 | 1023 |
| 10749 | 1023 |
| 10750 | 1023 |
| 10751 | 1023 |
| 10752 | 1023 |
| 10753 | 1023 |
| 10754 | 1023 |
| 10755 | 1023 |
| 10756 | 1023 |
| 10757 | 1023 |
| 10758 | 1023 |
| 10759 | 1023 |
| 10760 | 1023 |
| 10761 | 1023 |
| 10762 | 1023 |
| 10763 | 1023 |
| 10764 | 1023 |
| 10765 | 0 |
| 10766 | 0 |
| 10767 | 0 |
| 10768 | 0 |
| 10769 | 0 |
| 10770 | 0 |
| 10771 | 0 |
| 10772 | 0 |
| 10773 | 0 |
| 10774 | 0 |
| 10775 | 0 |
| 10776 | 0 |
| 10777 | 0 |
| 10778 | 1023 |
| 10779 | 1023 |
| 10780 | 1023 |
| 10781 | 1023 |
| 10782 | 1023 |
| 10783 | 1023 |
| 10784 | 1023 |
| 10785 | 1023 |
| 10786 | 1023 |
| 10787 | 1023 |
| 10788 | 1023 |
| 10789 | 1023 |
| 10790 | 1023 |
| 10791 | 1023 |
| 10792 | 1023 |
| 10793 | 1023 |
| 10794 | 1023 |
| 10795 | 1023 |
| 10796 | 1023 |
| 10797 | 1023 |
| 10798 | 1023 |
| 10799 | 1023 |
| 10800 | 1023 |
| 10801 | 1023 |
| 10802 | 1023 |
| 10803 | 1023 |
| 10804 | 1023 |
| 10805 | 1023 |
| 10806 | 1023 |
| 10807 | 1023 |
| 10808 | 1023 |
| 10809 | 1023 |
| 10810 | 1023 |
| 10811 | 1023 |
| 10812 | 1023 |
| 10813 | 1023 |
| 10814 | 1023 |
| 10815 | 1023 |
| 10816 | 0 |
| 10817 | 0 |
| 10818 | 0 |
| 10819 | 0 |
| 10820 | 0 |
| 10821 | 0 |
| 10822 | 0 |
| 10823 | 0 |
| 10824 | 0 |
| 10825 | 0 |
| 10826 | 0 |
| 10827 | 0 |
| 10828 | 0 |
| 10829 | 1023 |
| 10830 | 1023 |
| 10831 | 1023 |
| 10832 | 1023 |
| 10833 | 1023 |
| 10834 | 1023 |
| 10835 | 1023 |
| 10836 | 1023 |
| 10837 | 1023 |
| 10838 | 1023 |
| 10839 | 1023 |
| 10840 | 1023 |
| 10841 | 1023 |
| 10842 | 1023 |
| 10843 | 1023 |
| 10844 | 1023 |
| 10845 | 1023 |
| 10846 | 1023 |
| 10847 | 1023 |
| 10848 | 1023 |
| 10849 | 1023 |
| 10850 | 1023 |
| 10851 | 1023 |
| 10852 | 1023 |
| 10853 | 1023 |
| 10854 | 1023 |
| 10855 | 1023 |
| 10856 | 1023 |
| 10857 | 1023 |
| 10858 | 1023 |
| 10859 | 1023 |
| 10860 | 1023 |
| 10861 | 1023 |
| 10862 | 1023 |
| 10863 | 1023 |
| 10864 | 1023 |
| 10865 | 1023 |
| 10866 | 1023 |
| 10867 | 0 |
| 10868 | 0 |
| 10869 | 0 |
| 10870 | 0 |
| 10871 | 0 |
| 10872 | 0 |
| 10873 | 0 |
| 10874 | 0 |
| 10875 | 0 |
| 10876 | 0 |
| 10877 | 0 |
| 10878 | 0 |
| 10879 | 0 |
| 10880 | 1023 |
| 10881 | 1023 |
| 10882 | 1023 |
| 10883 | 1023 |
| 10884 | 1023 |
| 10885 | 1023 |
| 10886 | 1023 |
| 10887 | 1023 |
| 10888 | 1023 |
| 10889 | 1023 |
| 10890 | 1023 |
| 10891 | 1023 |
| 10892 | 1023 |
| 10893 | 1023 |
| 10894 | 1023 |
| 10895 | 1023 |
| 10896 | 1023 |
| 10897 | 1023 |
| 10898 | 1023 |
| 10899 | 1023 |
| 10900 | 1023 |
| 10901 | 1023 |
| 10902 | 1023 |
| 10903 | 1023 |
| 10904 | 1023 |
| 10905 | 1023 |
| 10906 | 1023 |
| 10907 | 1023 |
| 10908 | 1023 |
| 10909 | 1023 |
| 10910 | 1023 |
| 10911 | 1023 |
| 10912 | 1023 |
| 10913 | 1023 |
| 10914 | 1023 |
| 10915 | 1023 |
| 10916 | 1023 |
| 10917 | 1023 |
| 10918 | 0 |
| 10919 | 0 |
| 10920 | 0 |
| 10921 | 0 |
| 10922 | 0 |
| 10923 | 0 |
| 10924 | 0 |
| 10925 | 0 |
| 10926 | 0 |
| 10927 | 0 |
| 10928 | 0 |
| 10929 | 0 |
| 10930 | 0 |
| 10931 | 1023 |
| 10932 | 1023 |
| 10933 | 1023 |
| 10934 | 1023 |
| 10935 | 1023 |
| 10936 | 1023 |
| 10937 | 1023 |
| 10938 | 1023 |
| 10939 | 1023 |
| 10940 | 1023 |
| 10941 | 1023 |
| 10942 | 1023 |
| 10943 | 1023 |
| 10944 | 1023 |
| 10945 | 1023 |
| 10946 | 1023 |
| 10947 | 1023 |
| 10948 | 1023 |
| 10949 | 1023 |
| 10950 | 1023 |
| 10951 | 1023 |
| 10952 | 1023 |
| 10953 | 1023 |
| 10954 | 1023 |
| 10955 | 1023 |
| 10956 | 1023 |
| 10957 | 1023 |
| 10958 | 1023 |
| 10959 | 1023 |
| 10960 | 1023 |
| 10961 | 1023 |
| 10962 | 1023 |
| 10963 | 1023 |
| 10964 | 1023 |
| 10965 | 1023 |
| 10966 | 1023 |
| 10967 | 1023 |
| 10968 | 1023 |
| 10969 | 0 |
| 10970 | 0 |
| 10971 | 0 |
| 10972 | 0 |
| 10973 | 0 |
| 10974 | 0 |
| 10975 | 0 |
| 10976 | 0 |
| 10977 | 0 |
| 10978 | 0 |
| 10979 | 0 |
| 10980 | 0 |
| 10981 | 0 |
| 10982 | 0 |
| 10983 | 1023 |
| 10984 | 1023 |
| 10985 | 1023 |
| 10986 | 1023 |
| 10987 | 1023 |
| 10988 | 1023 |
| 10989 | 1023 |
| 10990 | 1023 |
| 10991 | 1023 |
| 10992 | 1023 |
| 10993 | 1023 |
| 10994 | 1023 |
| 10995 | 1023 |
| 10996 | 1023 |
| 10997 | 1023 |
| 10998 | 1023 |
| 10999 | 1023 |
| 11000 | 1023 |
| 11001 | 1023 |
| 11002 | 1023 |
| 11003 | 1023 |
| 11004 | 1023 |
| 11005 | 1023 |
| 11006 | 1023 |
| 11007 | 1023 |
| 11008 | 1023 |
| 11009 | 1023 |
| 11010 | 1023 |
| 11011 | 1023 |
| 11012 | 1023 |
| 11013 | 1023 |
| 11014 | 1023 |
| 11015 | 1023 |
| 11016 | 1023 |
| 11017 | 1023 |
| 11018 | 1023 |
| 11019 | 1023 |
| 11020 | 0 |
| 11021 | 0 |
| 11022 | 0 |
| 11023 | 0 |
| 11024 | 0 |
| 11025 | 0 |
| 11026 | 0 |
| 11027 | 0 |
| 11028 | 0 |
| 11029 | 0 |
| 11030 | 0 |
| 11031 | 0 |
| 11032 | 0 |
| 11033 | 0 |
| 11034 | 1023 |
| 11035 | 1023 |
| 11036 | 1023 |
| 11037 | 1023 |
| 11038 | 1023 |
| 11039 | 1023 |
| 11040 | 1023 |
| 11041 | 1023 |
| 11042 | 1023 |
| 11043 | 1023 |
| 11044 | 1023 |
| 11045 | 1023 |
| 11046 | 1023 |
| 11047 | 1023 |
| 11048 | 1023 |
| 11049 | 1023 |
| 11050 | 1023 |
| 11051 | 1023 |
| 11052 | 1023 |
| 11053 | 1023 |
| 11054 | 1023 |
| 11055 | 1023 |
| 11056 | 1023 |
| 11057 | 1023 |
| 11058 | 1023 |
| 11059 | 1023 |
| 11060 | 1023 |
| 11061 | 1023 |
| 11062 | 1023 |
| 11063 | 1023 |
| 11064 | 1023 |
| 11065 | 1023 |
| 11066 | 1023 |
| 11067 | 1023 |
| 11068 | 1023 |
| 11069 | 1023 |
| 11070 | 1023 |
| 11071 | 1023 |
| 11072 | 0 |
| 11073 | 0 |
| 11074 | 0 |
| 11075 | 0 |
| 11076 | 0 |
| 11077 | 0 |
| 11078 | 0 |
| 11079 | 0 |
| 11080 | 0 |
| 11081 | 0 |
| 11082 | 0 |
| 11083 | 0 |
| 11084 | 0 |
| 11085 | 0 |
| 11086 | 1023 |
| 11087 | 1023 |
| 11088 | 1023 |
| 11089 | 1023 |
| 11090 | 1023 |
| 11091 | 1023 |
| 11092 | 1023 |
| 11093 | 1023 |
| 11094 | 1023 |
| 11095 | 1023 |
| 11096 | 1023 |
| 11097 | 1023 |
| 11098 | 1023 |
| 11099 | 1023 |
| 11100 | 1023 |
| 11101 | 1023 |
| 11102 | 1023 |
| 11103 | 1023 |
| 11104 | 1023 |
| 11105 | 1023 |
| 11106 | 1023 |
| 11107 | 1023 |
| 11108 | 1023 |
| 11109 | 1023 |
| 11110 | 1023 |
| 11111 | 1023 |
| 11112 | 1023 |
| 11113 | 1023 |
| 11114 | 1023 |
| 11115 | 1023 |
| 11116 | 1023 |
| 11117 | 1023 |
| 11118 | 1023 |
| 11119 | 1023 |
| 11120 | 1023 |
| 11121 | 1023 |
| 11122 | 1023 |
| 11123 | 0 |
| 11124 | 0 |
| 11125 | 0 |
| 11126 | 0 |
| 11127 | 0 |
| 11128 | 0 |
| 11129 | 0 |
| 11130 | 0 |
| 11131 | 0 |
| 11132 | 0 |
| 11133 | 0 |
| 11134 | 0 |
| 11135 | 0 |
| 11136 | 0 |
| 11137 | 0 |
| 11138 | 1023 |
| 11139 | 1023 |
| 11140 | 1023 |
| 11141 | 1023 |
| 11142 | 1023 |
| 11143 | 1023 |
| 11144 | 1023 |
| 11145 | 1023 |
| 11146 | 1023 |
| 11147 | 1023 |
| 11148 | 1023 |
| 11149 | 1023 |
| 11150 | 1023 |
| 11151 | 1023 |
| 11152 | 1023 |
| 11153 | 1023 |
| 11154 | 1023 |
| 11155 | 1023 |
| 11156 | 1023 |
| 11157 | 1023 |
| 11158 | 1023 |
| 11159 | 1023 |
| 11160 | 1023 |
| 11161 | 1023 |
| 11162 | 1023 |
| 11163 | 1023 |
| 11164 | 1023 |
| 11165 | 1023 |
| 11166 | 1023 |
| 11167 | 1023 |
| 11168 | 1023 |
| 11169 | 1023 |
| 11170 | 1023 |
| 11171 | 1023 |
| 11172 | 1023 |
| 11173 | 1023 |
| 11174 | 1023 |
| 11175 | 0 |
| 11176 | 0 |
| 11177 | 0 |
| 11178 | 0 |
| 11179 | 0 |
| 11180 | 0 |
| 11181 | 0 |
| 11182 | 0 |
| 11183 | 0 |
| 11184 | 0 |
| 11185 | 0 |
| 11186 | 0 |
| 11187 | 0 |
| 11188 | 0 |
| 11189 | 0 |
| 11190 | 1023 |
| 11191 | 1023 |
| 11192 | 1023 |
| 11193 | 1023 |
| 11194 | 1023 |
| 11195 | 1023 |
| 11196 | 1023 |
| 11197 | 1023 |
| 11198 | 1023 |
| 11199 | 1023 |
| 11200 | 1023 |
| 11201 | 1023 |
| 11202 | 1023 |
| 11203 | 1023 |
| 11204 | 1023 |
| 11205 | 1023 |
| 11206 | 1023 |
| 11207 | 1023 |
| 11208 | 1023 |
| 11209 | 1023 |
| 11210 | 1023 |
| 11211 | 1023 |
| 11212 | 1023 |
| 11213 | 1023 |
| 11214 | 1023 |
| 11215 | 1023 |
| 11216 | 1023 |
| 11217 | 1023 |
| 11218 | 1023 |
| 11219 | 1023 |
| 11220 | 1023 |
| 11221 | 1023 |
| 11222 | 1023 |
| 11223 | 1023 |
| 11224 | 1023 |
| 11225 | 1023 |
| 11226 | 1023 |
| 11227 | 1023 |
| 11228 | 0 |
| 11229 | 0 |
| 11230 | 0 |
| 11231 | 0 |
| 11232 | 0 |
| 11233 | 0 |
| 11234 | 0 |
| 11235 | 0 |
| 11236 | 0 |
| 11237 | 0 |
| 11238 | 0 |
| 11239 | 0 |
| 11240 | 0 |
| 11241 | 1023 |
| 11242 | 1023 |
| 11243 | 1023 |
| 11244 | 1023 |
| 11245 | 1023 |
| 11246 | 1023 |
| 11247 | 1023 |
| 11248 | 1023 |
| 11249 | 1023 |
| 11250 | 1023 |
| 11251 | 1023 |
| 11252 | 1023 |
| 11253 | 1023 |
| 11254 | 1023 |
| 11255 | 1023 |
| 11256 | 1023 |
| 11257 | 1023 |
| 11258 | 1023 |
| 11259 | 1023 |
| 11260 | 1023 |
| 11261 | 1023 |
| 11262 | 1023 |
| 11263 | 1023 |
| 11264 | 1023 |
| 11265 | 1023 |
| 11266 | 1023 |
| 11267 | 1023 |
| 11268 | 1023 |
| 11269 | 1023 |
| 11270 | 1023 |
| 11271 | 1023 |
| 11272 | 1023 |
| 11273 | 1023 |
| 11274 | 1023 |
| 11275 | 1023 |
| 11276 | 1023 |
| 11277 | 1023 |
| 11278 | 1023 |
| 11279 | 0 |
| 11280 | 0 |
| 11281 | 0 |
| 11282 | 0 |
| 11283 | 0 |
| 11284 | 0 |
| 11285 | 0 |
| 11286 | 1 |
| 11287 | 0 |
| 11288 | 0 |
| 11289 | 0 |
| 11290 | 0 |
| 11291 | 0 |
| 11292 | 1023 |
| 11293 | 1023 |
| 11294 | 1023 |
| 11295 | 1023 |
| 11296 | 1023 |
| 11297 | 1023 |
| 11298 | 1023 |
| 11299 | 1023 |
| 11300 | 1023 |
| 11301 | 1023 |
| 11302 | 1023 |
| 11303 | 1023 |
| 11304 | 1023 |
| 11305 | 1023 |
| 11306 | 1023 |
| 11307 | 1023 |
| 11308 | 1023 |
| 11309 | 1023 |
| 11310 | 1023 |
| 11311 | 1023 |
| 11312 | 1023 |
| 11313 | 1023 |
| 11314 | 1023 |
| 11315 | 1023 |
| 11316 | 1023 |
| 11317 | 1023 |
| 11318 | 1023 |
| 11319 | 1023 |
| 11320 | 1023 |
| 11321 | 1023 |
| 11322 | 1023 |
| 11323 | 1023 |
| 11324 | 1023 |
| 11325 | 1023 |
| 11326 | 1023 |
| 11327 | 1023 |
| 11328 | 1023 |
| 11329 | 1023 |
| 11330 | 0 |
| 11331 | 0 |
| 11332 | 0 |
| 11333 | 0 |
| 11334 | 0 |
| 11335 | 0 |
| 11336 | 0 |
| 11337 | 0 |
| 11338 | 0 |
| 11339 | 0 |
| 11340 | 0 |
| 11341 | 0 |
| 11342 | 0 |
| 11343 | 1023 |
| 11344 | 1023 |
| 11345 | 1023 |
| 11346 | 1023 |
| 11347 | 1023 |
| 11348 | 1023 |
| 11349 | 1023 |
| 11350 | 1023 |
| 11351 | 1023 |
| 11352 | 1023 |
| 11353 | 1023 |
| 11354 | 1023 |
| 11355 | 1023 |
| 11356 | 1023 |
| 11357 | 1023 |
| 11358 | 1023 |
| 11359 | 1023 |
| 11360 | 1023 |
| 11361 | 1023 |
| 11362 | 1023 |
| 11363 | 1023 |
| 11364 | 1023 |
| 11365 | 1023 |
| 11366 | 1023 |
| 11367 | 1023 |
| 11368 | 1023 |
| 11369 | 1023 |
| 11370 | 1023 |
| 11371 | 1023 |
| 11372 | 1023 |
| 11373 | 1023 |
| 11374 | 1023 |
| 11375 | 1023 |
| 11376 | 1023 |
| 11377 | 1023 |
| 11378 | 1023 |
| 11379 | 1023 |
| 11380 | 1023 |
| 11381 | 0 |
| 11382 | 0 |
| 11383 | 0 |
| 11384 | 0 |
| 11385 | 0 |
| 11386 | 0 |
| 11387 | 1 |
| 11388 | 0 |
| 11389 | 0 |
| 11390 | 0 |
| 11391 | 0 |
| 11392 | 0 |
| 11393 | 0 |
| 11394 | 1023 |
| 11395 | 1023 |
| 11396 | 1023 |
| 11397 | 1023 |
| 11398 | 1023 |
| 11399 | 1023 |
| 11400 | 1023 |
| 11401 | 1023 |
| 11402 | 1023 |
| 11403 | 1023 |
| 11404 | 1023 |
| 11405 | 1023 |
| 11406 | 1023 |
| 11407 | 1023 |
| 11408 | 1023 |
| 11409 | 1023 |
| 11410 | 1023 |
| 11411 | 1023 |
| 11412 | 1023 |
| 11413 | 1023 |
| 11414 | 1023 |
| 11415 | 1023 |
| 11416 | 1023 |
| 11417 | 1023 |
| 11418 | 1023 |
| 11419 | 1023 |
| 11420 | 1023 |
| 11421 | 1023 |
| 11422 | 1023 |
| 11423 | 1023 |
| 11424 | 1023 |
| 11425 | 1023 |
| 11426 | 1023 |
| 11427 | 1023 |
| 11428 | 1023 |
| 11429 | 1023 |
| 11430 | 1023 |
| 11431 | 1023 |
| 11432 | 0 |
| 11433 | 0 |
| 11434 | 0 |
| 11435 | 0 |
| 11436 | 0 |
| 11437 | 0 |
| 11438 | 0 |
| 11439 | 0 |
| 11440 | 0 |
| 11441 | 0 |
| 11442 | 0 |
| 11443 | 0 |
| 11444 | 0 |
| 11445 | 1023 |
| 11446 | 1023 |
| 11447 | 1023 |
| 11448 | 1023 |
| 11449 | 1023 |
| 11450 | 1023 |
| 11451 | 1023 |
| 11452 | 1023 |
| 11453 | 1023 |
| 11454 | 1023 |
| 11455 | 1023 |
| 11456 | 1023 |
| 11457 | 1023 |
| 11458 | 1023 |
| 11459 | 1023 |
| 11460 | 1023 |
| 11461 | 1023 |
| 11462 | 1023 |
| 11463 | 1023 |
| 11464 | 1023 |
| 11465 | 1023 |
| 11466 | 1023 |
| 11467 | 1023 |
| 11468 | 1023 |
| 11469 | 1023 |
| 11470 | 1023 |
| 11471 | 1023 |
| 11472 | 1023 |
| 11473 | 1023 |
| 11474 | 1023 |
| 11475 | 1023 |
| 11476 | 1023 |
| 11477 | 1023 |
| 11478 | 1023 |
| 11479 | 1023 |
| 11480 | 1023 |
| 11481 | 1023 |
| 11482 | 1023 |
| 11483 | 0 |
| 11484 | 0 |
| 11485 | 0 |
| 11486 | 0 |
| 11487 | 0 |
| 11488 | 0 |
| 11489 | 0 |
| 11490 | 0 |
| 11491 | 0 |
| 11492 | 0 |
| 11493 | 0 |
| 11494 | 0 |
| 11495 | 0 |
| 11496 | 1023 |
| 11497 | 1023 |
| 11498 | 1023 |
| 11499 | 1023 |
| 11500 | 1023 |
| 11501 | 1023 |
| 11502 | 1023 |
| 11503 | 1023 |
| 11504 | 1023 |
| 11505 | 1023 |
| 11506 | 1023 |
| 11507 | 1023 |
| 11508 | 1023 |
| 11509 | 1023 |
| 11510 | 1023 |
| 11511 | 1023 |
| 11512 | 1023 |
| 11513 | 1023 |
| 11514 | 1023 |
| 11515 | 1023 |
| 11516 | 1023 |
| 11517 | 1023 |
| 11518 | 1023 |
| 11519 | 1023 |
| 11520 | 1023 |
| 11521 | 1023 |
| 11522 | 1023 |
| 11523 | 1023 |
| 11524 | 1023 |
| 11525 | 1023 |
| 11526 | 1023 |
| 11527 | 1023 |
| 11528 | 1023 |
| 11529 | 1023 |
| 11530 | 1023 |
| 11531 | 1023 |
| 11532 | 1023 |
| 11533 | 1023 |
| 11534 | 0 |
| 11535 | 0 |
| 11536 | 0 |
| 11537 | 0 |
| 11538 | 0 |
| 11539 | 0 |
| 11540 | 0 |
| 11541 | 0 |
| 11542 | 0 |
| 11543 | 0 |
| 11544 | 0 |
| 11545 | 0 |
| 11546 | 0 |
| 11547 | 1023 |
| 11548 | 1023 |
| 11549 | 1023 |
| 11550 | 1023 |
| 11551 | 1023 |
| 11552 | 1023 |
| 11553 | 1023 |
| 11554 | 1023 |
| 11555 | 1023 |
| 11556 | 1023 |
| 11557 | 1023 |
| 11558 | 1023 |
| 11559 | 1023 |
| 11560 | 1023 |
| 11561 | 1023 |
| 11562 | 1023 |
| 11563 | 1023 |
| 11564 | 1023 |
| 11565 | 1023 |
| 11566 | 1023 |
| 11567 | 1023 |
| 11568 | 1023 |
| 11569 | 1023 |
| 11570 | 1023 |
| 11571 | 1023 |
| 11572 | 1023 |
| 11573 | 1023 |
| 11574 | 1023 |
| 11575 | 1023 |
| 11576 | 1023 |
| 11577 | 1023 |
| 11578 | 1023 |
| 11579 | 1023 |
| 11580 | 1023 |
| 11581 | 1023 |
| 11582 | 1023 |
| 11583 | 1023 |
| 11584 | 1023 |
| 11585 | 0 |
| 11586 | 0 |
| 11587 | 0 |
| 11588 | 0 |
| 11589 | 0 |
| 11590 | 0 |
| 11591 | 0 |
| 11592 | 0 |
| 11593 | 0 |
| 11594 | 0 |
| 11595 | 0 |
| 11596 | 0 |
| 11597 | 0 |
| 11598 | 0 |
| 11599 | 1023 |
| 11600 | 1023 |
| 11601 | 1023 |
| 11602 | 1023 |
| 11603 | 1023 |
| 11604 | 1023 |
| 11605 | 1023 |
| 11606 | 1023 |
| 11607 | 1023 |
| 11608 | 1023 |
| 11609 | 1023 |
| 11610 | 1023 |
| 11611 | 1023 |
| 11612 | 1023 |
| 11613 | 1023 |
| 11614 | 1023 |
| 11615 | 1023 |
| 11616 | 1023 |
| 11617 | 1023 |
| 11618 | 1023 |
| 11619 | 1023 |
| 11620 | 1023 |
| 11621 | 1023 |
| 11622 | 1023 |
| 11623 | 1023 |
| 11624 | 1023 |
| 11625 | 1023 |
| 11626 | 1023 |
| 11627 | 1023 |
| 11628 | 1023 |
| 11629 | 1023 |
| 11630 | 1023 |
| 11631 | 1023 |
| 11632 | 1023 |
| 11633 | 1023 |
| 11634 | 1023 |
| 11635 | 1023 |
| 11636 | 0 |
| 11637 | 0 |
| 11638 | 0 |
| 11639 | 0 |
| 11640 | 0 |
| 11641 | 0 |
| 11642 | 0 |
| 11643 | 0 |
| 11644 | 0 |
| 11645 | 0 |
| 11646 | 0 |
| 11647 | 0 |
| 11648 | 0 |
| 11649 | 0 |
| 11650 | 1023 |
| 11651 | 1023 |
| 11652 | 1023 |
| 11653 | 1023 |
| 11654 | 1023 |
| 11655 | 1023 |
| 11656 | 1023 |
| 11657 | 1023 |
| 11658 | 1023 |
| 11659 | 1023 |
| 11660 | 1023 |
| 11661 | 1023 |
| 11662 | 1023 |
| 11663 | 1023 |
| 11664 | 1023 |
| 11665 | 1023 |
| 11666 | 1023 |
| 11667 | 1023 |
| 11668 | 1023 |
| 11669 | 1023 |
| 11670 | 1023 |
| 11671 | 1023 |
| 11672 | 1023 |
| 11673 | 1023 |
| 11674 | 1023 |
| 11675 | 1023 |
| 11676 | 1023 |
| 11677 | 1023 |
| 11678 | 1023 |
| 11679 | 1023 |
| 11680 | 1023 |
| 11681 | 1023 |
| 11682 | 1023 |
| 11683 | 1023 |
| 11684 | 1023 |
| 11685 | 1023 |
| 11686 | 1023 |
| 11687 | 1023 |
| 11688 | 0 |
| 11689 | 0 |
| 11690 | 0 |
| 11691 | 0 |
| 11692 | 0 |
| 11693 | 0 |
| 11694 | 0 |
| 11695 | 0 |
| 11696 | 0 |
| 11697 | 0 |
| 11698 | 0 |
| 11699 | 0 |
| 11700 | 0 |
| 11701 | 0 |
| 11702 | 1023 |
| 11703 | 1023 |
| 11704 | 1023 |
| 11705 | 1023 |
| 11706 | 1023 |
| 11707 | 1023 |
| 11708 | 1023 |
| 11709 | 1023 |
| 11710 | 1023 |
| 11711 | 1023 |
| 11712 | 1023 |
| 11713 | 1023 |
| 11714 | 1023 |
| 11715 | 1023 |
| 11716 | 1023 |
| 11717 | 1023 |
| 11718 | 1023 |
| 11719 | 1023 |
| 11720 | 1023 |
| 11721 | 1023 |
| 11722 | 1023 |
| 11723 | 1023 |
| 11724 | 1023 |
| 11725 | 1023 |
| 11726 | 1023 |
| 11727 | 1023 |
| 11728 | 1023 |
| 11729 | 1023 |
| 11730 | 1023 |
| 11731 | 1023 |
| 11732 | 1023 |
| 11733 | 1023 |
| 11734 | 1023 |
| 11735 | 1023 |
| 11736 | 1023 |
| 11737 | 1023 |
| 11738 | 1023 |
| 11739 | 0 |
| 11740 | 0 |
| 11741 | 0 |
| 11742 | 0 |
| 11743 | 0 |
| 11744 | 0 |
| 11745 | 0 |
| 11746 | 0 |
| 11747 | 0 |
| 11748 | 0 |
| 11749 | 0 |
| 11750 | 0 |
| 11751 | 0 |
| 11752 | 0 |
| 11753 | 0 |
| 11754 | 1023 |
| 11755 | 1023 |
| 11756 | 1023 |
| 11757 | 1023 |
| 11758 | 1023 |
| 11759 | 1023 |
| 11760 | 1023 |
| 11761 | 1023 |
| 11762 | 1023 |
| 11763 | 1023 |
| 11764 | 1023 |
| 11765 | 1023 |
| 11766 | 1023 |
| 11767 | 1023 |
| 11768 | 1023 |
| 11769 | 1023 |
| 11770 | 1023 |
| 11771 | 1023 |
| 11772 | 1023 |
| 11773 | 1023 |
| 11774 | 1023 |
| 11775 | 1023 |
| 11776 | 1023 |
| 11777 | 1023 |
| 11778 | 1023 |
| 11779 | 1023 |
| 11780 | 1023 |
| 11781 | 1023 |
| 11782 | 1023 |
| 11783 | 1023 |
| 11784 | 1023 |
| 11785 | 1023 |
| 11786 | 1023 |
| 11787 | 1023 |
| 11788 | 1023 |
| 11789 | 1023 |
| 11790 | 1023 |
| 11791 | 0 |
| 11792 | 0 |
| 11793 | 0 |
| 11794 | 0 |
| 11795 | 0 |
| 11796 | 0 |
| 11797 | 0 |
| 11798 | 0 |
| 11799 | 0 |
| 11800 | 0 |
| 11801 | 0 |
| 11802 | 0 |
| 11803 | 0 |
| 11804 | 0 |
| 11805 | 0 |
| 11806 | 1023 |
| 11807 | 1023 |
| 11808 | 1023 |
| 11809 | 1023 |
| 11810 | 1023 |
| 11811 | 1023 |
| 11812 | 1023 |
| 11813 | 1023 |
| 11814 | 1023 |
| 11815 | 1023 |
| 11816 | 1023 |
| 11817 | 1023 |
| 11818 | 1023 |
| 11819 | 1023 |
| 11820 | 1023 |
| 11821 | 1023 |
| 11822 | 1023 |
| 11823 | 1023 |
| 11824 | 1023 |
| 11825 | 1023 |
| 11826 | 1023 |
| 11827 | 1023 |
| 11828 | 1023 |
| 11829 | 1023 |
| 11830 | 1023 |
| 11831 | 1023 |
| 11832 | 1023 |
| 11833 | 1023 |
| 11834 | 1023 |
| 11835 | 1023 |
| 11836 | 1023 |
| 11837 | 1023 |
| 11838 | 1023 |
| 11839 | 1023 |
| 11840 | 1023 |
| 11841 | 1023 |
| 11842 | 1023 |
| 11843 | 1023 |
| 11844 | 0 |
| 11845 | 0 |
| 11846 | 0 |
| 11847 | 0 |
| 11848 | 0 |
| 11849 | 0 |
| 11850 | 0 |
| 11851 | 0 |
| 11852 | 0 |
| 11853 | 0 |
| 11854 | 0 |
| 11855 | 0 |
| 11856 | 0 |
| 11857 | 1023 |
| 11858 | 1023 |
| 11859 | 1023 |
| 11860 | 1023 |
| 11861 | 1023 |
| 11862 | 1023 |
| 11863 | 1023 |
| 11864 | 1023 |
| 11865 | 1023 |
| 11866 | 1023 |
| 11867 | 1023 |
| 11868 | 1023 |
| 11869 | 1023 |
| 11870 | 1023 |
| 11871 | 1023 |
| 11872 | 1023 |
| 11873 | 1023 |
| 11874 | 1023 |
| 11875 | 1023 |
| 11876 | 1023 |
| 11877 | 1023 |
| 11878 | 1023 |
| 11879 | 1023 |
| 11880 | 1023 |
| 11881 | 1023 |
| 11882 | 1023 |
| 11883 | 1023 |
| 11884 | 1023 |
| 11885 | 1023 |
| 11886 | 1023 |
| 11887 | 1023 |
| 11888 | 1023 |
| 11889 | 1023 |
| 11890 | 1023 |
| 11891 | 1023 |
| 11892 | 1023 |
| 11893 | 1023 |
| 11894 | 1023 |
| 11895 | 0 |
| 11896 | 0 |
| 11897 | 0 |
| 11898 | 0 |
| 11899 | 0 |
| 11900 | 0 |
| 11901 | 0 |
| 11902 | 0 |
| 11903 | 0 |
| 11904 | 0 |
| 11905 | 0 |
| 11906 | 0 |
| 11907 | 0 |
| 11908 | 1023 |
| 11909 | 1023 |
| 11910 | 1023 |
| 11911 | 1023 |
| 11912 | 1023 |
| 11913 | 1023 |
| 11914 | 1023 |
| 11915 | 1023 |
| 11916 | 1023 |
| 11917 | 1023 |
| 11918 | 1023 |
| 11919 | 1023 |
| 11920 | 1023 |
| 11921 | 1023 |
| 11922 | 1023 |
| 11923 | 1023 |
| 11924 | 1023 |
| 11925 | 1023 |
| 11926 | 1023 |
| 11927 | 1023 |
| 11928 | 1023 |
| 11929 | 1023 |
| 11930 | 1023 |
| 11931 | 1023 |
| 11932 | 1023 |
| 11933 | 1023 |
| 11934 | 1023 |
| 11935 | 1023 |
| 11936 | 1023 |
| 11937 | 1023 |
| 11938 | 1023 |
| 11939 | 1023 |
| 11940 | 1023 |
| 11941 | 1023 |
| 11942 | 1023 |
| 11943 | 1023 |
| 11944 | 1023 |
| 11945 | 1023 |
| 11946 | 0 |
| 11947 | 0 |
| 11948 | 0 |
| 11949 | 0 |
| 11950 | 0 |
| 11951 | 0 |
| 11952 | 0 |
| 11953 | 0 |
| 11954 | 0 |
| 11955 | 0 |
| 11956 | 0 |
| 11957 | 0 |
| 11958 | 0 |
| 11959 | 1023 |
| 11960 | 1023 |
| 11961 | 1023 |
| 11962 | 1023 |
| 11963 | 1023 |
| 11964 | 1023 |
| 11965 | 1023 |
| 11966 | 1023 |
| 11967 | 1023 |
| 11968 | 1023 |
| 11969 | 1023 |
| 11970 | 1023 |
| 11971 | 1023 |
| 11972 | 1023 |
| 11973 | 1023 |
| 11974 | 1023 |
| 11975 | 1023 |
| 11976 | 1023 |
| 11977 | 1023 |
| 11978 | 1023 |
| 11979 | 1023 |
| 11980 | 1023 |
| 11981 | 1023 |
| 11982 | 1023 |
| 11983 | 1023 |
| 11984 | 1023 |
| 11985 | 1023 |
| 11986 | 1023 |
| 11987 | 1023 |
| 11988 | 1023 |
| 11989 | 1023 |
| 11990 | 1023 |
| 11991 | 1023 |
| 11992 | 1023 |
| 11993 | 1023 |
| 11994 | 1023 |
| 11995 | 1023 |
| 11996 | 1023 |
| 11997 | 0 |
| 11998 | 0 |
| 11999 | 0 |
| 12000 | 0 |
| 12001 | 0 |
| 12002 | 0 |
| 12003 | 0 |
| 12004 | 0 |
| 12005 | 0 |
| 12006 | 0 |
| 12007 | 0 |
| 12008 | 0 |
| 12009 | 0 |
| 12010 | 1023 |
| 12011 | 1023 |
| 12012 | 1023 |
| 12013 | 1023 |
| 12014 | 1023 |
| 12015 | 1023 |
| 12016 | 1023 |
| 12017 | 1023 |
| 12018 | 1023 |
| 12019 | 1023 |
| 12020 | 1023 |
| 12021 | 1023 |
| 12022 | 1023 |
| 12023 | 1023 |
| 12024 | 1023 |
| 12025 | 1023 |
| 12026 | 1023 |
| 12027 | 1023 |
| 12028 | 1023 |
| 12029 | 1023 |
| 12030 | 1023 |
| 12031 | 1023 |
| 12032 | 1023 |
| 12033 | 1023 |
| 12034 | 1023 |
| 12035 | 1023 |
| 12036 | 1023 |
| 12037 | 1023 |
| 12038 | 1023 |
| 12039 | 1023 |
| 12040 | 1023 |
| 12041 | 1023 |
| 12042 | 1023 |
| 12043 | 1023 |
| 12044 | 1023 |
| 12045 | 1023 |
| 12046 | 1023 |
| 12047 | 1023 |
| 12048 | 0 |
| 12049 | 0 |
| 12050 | 0 |
| 12051 | 0 |
| 12052 | 0 |
| 12053 | 0 |
| 12054 | 0 |
| 12055 | 0 |
| 12056 | 0 |
| 12057 | 0 |
| 12058 | 0 |
| 12059 | 0 |
| 12060 | 0 |
| 12061 | 1023 |
| 12062 | 1023 |
| 12063 | 1023 |
| 12064 | 1023 |
| 12065 | 1023 |
| 12066 | 1023 |
| 12067 | 1023 |
| 12068 | 1023 |
| 12069 | 1023 |
| 12070 | 1023 |
| 12071 | 1023 |
| 12072 | 1023 |
| 12073 | 1023 |
| 12074 | 1023 |
| 12075 | 1023 |
| 12076 | 1023 |
| 12077 | 1023 |
| 12078 | 1023 |
| 12079 | 1023 |
| 12080 | 1023 |
| 12081 | 1023 |
| 12082 | 1023 |
| 12083 | 1023 |
| 12084 | 1023 |
| 12085 | 1023 |
| 12086 | 1023 |
| 12087 | 1023 |
| 12088 | 1023 |
| 12089 | 1023 |
| 12090 | 1023 |
| 12091 | 1023 |
| 12092 | 1023 |
| 12093 | 1023 |
| 12094 | 1023 |
| 12095 | 1023 |
| 12096 | 1023 |
| 12097 | 1023 |
| 12098 | 1023 |
| 12099 | 0 |
| 12100 | 0 |
| 12101 | 0 |
| 12102 | 0 |
| 12103 | 0 |
| 12104 | 0 |
| 12105 | 0 |
| 12106 | 0 |
| 12107 | 0 |
| 12108 | 0 |
| 12109 | 0 |
| 12110 | 0 |
| 12111 | 0 |
| 12112 | 1023 |
| 12113 | 1023 |
| 12114 | 1023 |
| 12115 | 1023 |
| 12116 | 1023 |
| 12117 | 1023 |
| 12118 | 1023 |
| 12119 | 1023 |
| 12120 | 1023 |
| 12121 | 1023 |
| 12122 | 1023 |
| 12123 | 1023 |
| 12124 | 1023 |
| 12125 | 1023 |
| 12126 | 1023 |
| 12127 | 1023 |
| 12128 | 1023 |
| 12129 | 1023 |
| 12130 | 1023 |
| 12131 | 1023 |
| 12132 | 1023 |
| 12133 | 1023 |
| 12134 | 1023 |
| 12135 | 1023 |
| 12136 | 1023 |
| 12137 | 1023 |
| 12138 | 1023 |
| 12139 | 1023 |
| 12140 | 1023 |
| 12141 | 1023 |
| 12142 | 1023 |
| 12143 | 1023 |
| 12144 | 1023 |
| 12145 | 1023 |
| 12146 | 1023 |
| 12147 | 1023 |
| 12148 | 1023 |
| 12149 | 1023 |
| 12150 | 0 |
| 12151 | 0 |
| 12152 | 0 |
| 12153 | 0 |
| 12154 | 0 |
| 12155 | 0 |
| 12156 | 0 |
| 12157 | 1 |
| 12158 | 0 |
| 12159 | 0 |
| 12160 | 0 |
| 12161 | 0 |
| 12162 | 0 |
| 12163 | 421 |
| 12164 | 1023 |
| 12165 | 1023 |
| 12166 | 1023 |
| 12167 | 1023 |
| 12168 | 1023 |
| 12169 | 1023 |
| 12170 | 1023 |
| 12171 | 1023 |
| 12172 | 1023 |
| 12173 | 1023 |
| 12174 | 1023 |
| 12175 | 1023 |
| 12176 | 1023 |
| 12177 | 1023 |
| 12178 | 1023 |
| 12179 | 1023 |
| 12180 | 1023 |
| 12181 | 1023 |
| 12182 | 1023 |
| 12183 | 1023 |
| 12184 | 1023 |
| 12185 | 1023 |
| 12186 | 1023 |
| 12187 | 1023 |
| 12188 | 1023 |
| 12189 | 1023 |
| 12190 | 1023 |
| 12191 | 1023 |
| 12192 | 1023 |
| 12193 | 1023 |
| 12194 | 1023 |
| 12195 | 1023 |
| 12196 | 1023 |
| 12197 | 1023 |
| 12198 | 1023 |
| 12199 | 1023 |
| 12200 | 1023 |
| 12201 | 0 |
| 12202 | 0 |
| 12203 | 0 |
| 12204 | 0 |
| 12205 | 0 |
| 12206 | 0 |
| 12207 | 0 |
| 12208 | 0 |
| 12209 | 0 |
| 12210 | 0 |
| 12211 | 0 |
| 12212 | 0 |
| 12213 | 0 |
| 12214 | 0 |
| 12215 | 1023 |
| 12216 | 1023 |
| 12217 | 1023 |
| 12218 | 1023 |
| 12219 | 1023 |
| 12220 | 1023 |
| 12221 | 1023 |
| 12222 | 1023 |
| 12223 | 1023 |
| 12224 | 1023 |
| 12225 | 1023 |
| 12226 | 1023 |
| 12227 | 1023 |
| 12228 | 1023 |
| 12229 | 1023 |
| 12230 | 1023 |
| 12231 | 1023 |
| 12232 | 1023 |
| 12233 | 1023 |
| 12234 | 1023 |
| 12235 | 1023 |
| 12236 | 1023 |
| 12237 | 1023 |
| 12238 | 1023 |
| 12239 | 1023 |
| 12240 | 1023 |
| 12241 | 1023 |
| 12242 | 1023 |
| 12243 | 1023 |
| 12244 | 1023 |
| 12245 | 1023 |
| 12246 | 1023 |
| 12247 | 1023 |
| 12248 | 1023 |
| 12249 | 1023 |
| 12250 | 1023 |
| 12251 | 1023 |
| 12252 | 1023 |
| 12253 | 0 |
| 12254 | 0 |
| 12255 | 0 |
| 12256 | 0 |
| 12257 | 0 |
| 12258 | 0 |
| 12259 | 0 |
| 12260 | 0 |
| 12261 | 0 |
| 12262 | 0 |
| 12263 | 0 |
| 12264 | 0 |
| 12265 | 0 |
| 12266 | 1023 |
| 12267 | 1023 |
| 12268 | 1023 |
| 12269 | 1023 |
| 12270 | 1023 |
| 12271 | 1023 |
| 12272 | 1023 |
| 12273 | 1023 |
| 12274 | 1023 |
| 12275 | 1023 |
| 12276 | 1023 |
| 12277 | 1023 |
| 12278 | 1023 |
| 12279 | 1023 |
| 12280 | 1023 |
| 12281 | 1023 |
| 12282 | 1023 |
| 12283 | 1023 |
| 12284 | 1023 |
| 12285 | 1023 |
| 12286 | 1023 |
| 12287 | 1023 |
| 12288 | 1023 |
| 12289 | 1023 |
| 12290 | 1023 |
| 12291 | 1023 |
| 12292 | 1023 |
| 12293 | 1023 |
| 12294 | 1023 |
| 12295 | 1023 |
| 12296 | 1023 |
| 12297 | 1023 |
| 12298 | 1023 |
| 12299 | 1023 |
| 12300 | 1023 |
| 12301 | 1023 |
| 12302 | 1023 |
| 12303 | 1023 |
| 12304 | 0 |
| 12305 | 0 |
| 12306 | 0 |
| 12307 | 0 |
| 12308 | 0 |
| 12309 | 0 |
| 12310 | 0 |
| 12311 | 0 |
| 12312 | 0 |
| 12313 | 0 |
| 12314 | 0 |
| 12315 | 0 |
| 12316 | 0 |
| 12317 | 1023 |
| 12318 | 1023 |
| 12319 | 1023 |
| 12320 | 1023 |
| 12321 | 1023 |
| 12322 | 1023 |
| 12323 | 1023 |
| 12324 | 1023 |
| 12325 | 1023 |
| 12326 | 1023 |
| 12327 | 1023 |
| 12328 | 1023 |
| 12329 | 1023 |
| 12330 | 1023 |
| 12331 | 1023 |
| 12332 | 1023 |
| 12333 | 1023 |
| 12334 | 1023 |
| 12335 | 1023 |
| 12336 | 1023 |
| 12337 | 1023 |
| 12338 | 1023 |
| 12339 | 1023 |
| 12340 | 1023 |
| 12341 | 1023 |
| 12342 | 1023 |
| 12343 | 1023 |
| 12344 | 1023 |
| 12345 | 1023 |
| 12346 | 1023 |
| 12347 | 1023 |
| 12348 | 1023 |
| 12349 | 1023 |
| 12350 | 1023 |
| 12351 | 1023 |
| 12352 | 1023 |
| 12353 | 1023 |
| 12354 | 1023 |
| 12355 | 0 |
| 12356 | 0 |
| 12357 | 0 |
| 12358 | 0 |
| 12359 | 0 |
| 12360 | 0 |
| 12361 | 0 |
| 12362 | 0 |
| 12363 | 0 |
| 12364 | 0 |
| 12365 | 0 |
| 12366 | 0 |
| 12367 | 0 |
| 12368 | 1023 |
| 12369 | 1023 |
| 12370 | 1023 |
| 12371 | 1023 |
| 12372 | 1023 |
| 12373 | 1023 |
| 12374 | 1023 |
| 12375 | 1023 |
| 12376 | 1023 |
| 12377 | 1023 |
| 12378 | 1023 |
| 12379 | 1023 |
| 12380 | 1023 |
| 12381 | 1023 |
| 12382 | 1023 |
| 12383 | 1023 |
| 12384 | 1023 |
| 12385 | 1023 |
| 12386 | 1023 |
| 12387 | 1023 |
| 12388 | 1023 |
| 12389 | 1023 |
| 12390 | 1023 |
| 12391 | 1023 |
| 12392 | 1023 |
| 12393 | 1023 |
| 12394 | 1023 |
| 12395 | 1023 |
| 12396 | 1023 |
| 12397 | 1023 |
| 12398 | 1023 |
| 12399 | 1023 |
| 12400 | 1023 |
| 12401 | 1023 |
| 12402 | 1023 |
| 12403 | 1023 |
| 12404 | 1023 |
| 12405 | 1023 |
| 12406 | 0 |
| 12407 | 0 |
| 12408 | 0 |
| 12409 | 0 |
| 12410 | 0 |
| 12411 | 0 |
| 12412 | 0 |
| 12413 | 0 |
| 12414 | 0 |
| 12415 | 0 |
| 12416 | 0 |
| 12417 | 0 |
| 12418 | 0 |
| 12419 | 1023 |
| 12420 | 1023 |
| 12421 | 1023 |
| 12422 | 1023 |
| 12423 | 1023 |
| 12424 | 1023 |
| 12425 | 1023 |
| 12426 | 1023 |
| 12427 | 1023 |
| 12428 | 1023 |
| 12429 | 1023 |
| 12430 | 1023 |
| 12431 | 1023 |
| 12432 | 1023 |
| 12433 | 1023 |
| 12434 | 1023 |
| 12435 | 1023 |
| 12436 | 1023 |
| 12437 | 1023 |
| 12438 | 1023 |
| 12439 | 1023 |
| 12440 | 1023 |
| 12441 | 1023 |
| 12442 | 1023 |
| 12443 | 1023 |
| 12444 | 1023 |
| 12445 | 1023 |
| 12446 | 1023 |
| 12447 | 1023 |
| 12448 | 1023 |
| 12449 | 1023 |
| 12450 | 1023 |
| 12451 | 1023 |
| 12452 | 1023 |
| 12453 | 1023 |
| 12454 | 1023 |
| 12455 | 1023 |
| 12456 | 1023 |
| 12457 | 0 |
| 12458 | 0 |
| 12459 | 0 |
| 12460 | 0 |
| 12461 | 0 |
| 12462 | 0 |
| 12463 | 0 |
| 12464 | 0 |
| 12465 | 0 |
| 12466 | 0 |
| 12467 | 0 |
| 12468 | 0 |
| 12469 | 0 |
| 12470 | 1023 |
| 12471 | 1023 |
| 12472 | 1023 |
| 12473 | 1023 |
| 12474 | 1023 |
| 12475 | 1023 |
| 12476 | 1023 |
| 12477 | 1023 |
| 12478 | 1023 |
| 12479 | 1023 |
| 12480 | 1023 |
| 12481 | 1023 |
| 12482 | 1023 |
| 12483 | 1023 |
| 12484 | 1023 |
| 12485 | 1023 |
| 12486 | 1023 |
| 12487 | 1023 |
| 12488 | 1023 |
| 12489 | 1023 |
| 12490 | 1023 |
| 12491 | 1023 |
| 12492 | 1023 |
| 12493 | 1023 |
| 12494 | 1023 |
| 12495 | 1023 |
| 12496 | 1023 |
| 12497 | 1023 |
| 12498 | 1023 |
| 12499 | 1023 |
| 12500 | 1023 |
| 12501 | 1023 |
| 12502 | 1023 |
| 12503 | 1023 |
| 12504 | 1023 |
| 12505 | 1023 |
| 12506 | 1023 |
| 12507 | 1023 |
| 12508 | 0 |
| 12509 | 0 |
| 12510 | 0 |
| 12511 | 0 |
| 12512 | 0 |
| 12513 | 0 |
| 12514 | 0 |
| 12515 | 0 |
| 12516 | 0 |
| 12517 | 0 |
| 12518 | 0 |
| 12519 | 0 |
| 12520 | 0 |
| 12521 | 1023 |
| 12522 | 1023 |
| 12523 | 1023 |
| 12524 | 1023 |
| 12525 | 1023 |
| 12526 | 1023 |
| 12527 | 1023 |
| 12528 | 1023 |
| 12529 | 1023 |
| 12530 | 1023 |
| 12531 | 1023 |
| 12532 | 1023 |
| 12533 | 1023 |
| 12534 | 1023 |
| 12535 | 1023 |
| 12536 | 1023 |
| 12537 | 1023 |
| 12538 | 1023 |
| 12539 | 1023 |
| 12540 | 1023 |
| 12541 | 1023 |
| 12542 | 1023 |
| 12543 | 1023 |
| 12544 | 1023 |
| 12545 | 1023 |
| 12546 | 1023 |
| 12547 | 1023 |
| 12548 | 1023 |
| 12549 | 1023 |
| 12550 | 1023 |
| 12551 | 1023 |
| 12552 | 1023 |
| 12553 | 1023 |
| 12554 | 1023 |
| 12555 | 1023 |
| 12556 | 1023 |
| 12557 | 1023 |
| 12558 | 1023 |
| 12559 | 0 |
| 12560 | 0 |
| 12561 | 0 |
| 12562 | 0 |
| 12563 | 0 |
| 12564 | 0 |
| 12565 | 0 |
| 12566 | 0 |
| 12567 | 0 |
| 12568 | 0 |
| 12569 | 0 |
| 12570 | 0 |
| 12571 | 0 |
| 12572 | 1023 |
| 12573 | 1023 |
| 12574 | 1023 |
| 12575 | 1023 |
| 12576 | 1023 |
| 12577 | 1023 |
| 12578 | 1023 |
| 12579 | 1023 |
| 12580 | 1023 |
| 12581 | 1023 |
| 12582 | 1023 |
| 12583 | 1023 |
| 12584 | 1023 |
| 12585 | 1023 |
| 12586 | 1023 |
| 12587 | 1023 |
| 12588 | 1023 |
| 12589 | 1023 |
| 12590 | 1023 |
| 12591 | 1023 |
| 12592 | 1023 |
| 12593 | 1023 |
| 12594 | 1023 |
| 12595 | 1023 |
| 12596 | 1023 |
| 12597 | 1023 |
| 12598 | 1023 |
| 12599 | 1023 |
| 12600 | 1023 |
| 12601 | 1023 |
| 12602 | 1023 |
| 12603 | 1023 |
| 12604 | 1023 |
| 12605 | 1023 |
| 12606 | 1023 |
| 12607 | 1023 |
| 12608 | 1023 |
| 12609 | 1023 |
| 12610 | 0 |
| 12611 | 0 |
| 12612 | 0 |
| 12613 | 0 |
| 12614 | 0 |
| 12615 | 0 |
| 12616 | 0 |
| 12617 | 0 |
| 12618 | 0 |
| 12619 | 0 |
| 12620 | 1 |
| 12621 | 0 |
| 12622 | 0 |
| 12623 | 0 |
| 12624 | 1023 |
| 12625 | 1023 |
| 12626 | 1023 |
| 12627 | 1023 |
| 12628 | 1023 |
| 12629 | 1023 |
| 12630 | 1023 |
| 12631 | 1023 |
| 12632 | 1023 |
| 12633 | 1023 |
| 12634 | 1023 |
| 12635 | 1023 |
| 12636 | 1023 |
| 12637 | 1023 |
| 12638 | 1023 |
| 12639 | 1023 |
| 12640 | 1023 |
| 12641 | 1023 |
| 12642 | 1023 |
| 12643 | 1023 |
| 12644 | 1023 |
| 12645 | 1023 |
| 12646 | 1023 |
| 12647 | 1023 |
| 12648 | 1023 |
| 12649 | 1023 |
| 12650 | 1023 |
| 12651 | 1023 |
| 12652 | 1023 |
| 12653 | 1023 |
| 12654 | 1023 |
| 12655 | 1023 |
| 12656 | 1023 |
| 12657 | 1023 |
| 12658 | 1023 |
| 12659 | 1023 |
| 12660 | 1023 |
| 12661 | 0 |
| 12662 | 0 |
| 12663 | 0 |
| 12664 | 0 |
| 12665 | 0 |
| 12666 | 0 |
| 12667 | 0 |
| 12668 | 0 |
| 12669 | 0 |
| 12670 | 0 |
| 12671 | 0 |
| 12672 | 0 |
| 12673 | 0 |
| 12674 | 0 |
| 12675 | 1023 |
| 12676 | 1023 |
| 12677 | 1023 |
| 12678 | 1023 |
| 12679 | 1023 |
| 12680 | 1023 |
| 12681 | 1023 |
| 12682 | 1023 |
| 12683 | 1023 |
| 12684 | 1023 |
| 12685 | 1023 |
| 12686 | 1023 |
| 12687 | 1023 |
| 12688 | 1023 |
| 12689 | 1023 |
| 12690 | 1023 |
| 12691 | 1023 |
| 12692 | 1023 |
| 12693 | 1023 |
| 12694 | 1023 |
| 12695 | 1023 |
| 12696 | 1023 |
| 12697 | 1023 |
| 12698 | 1023 |
| 12699 | 1023 |
| 12700 | 1023 |
| 12701 | 1023 |
| 12702 | 1023 |
| 12703 | 1023 |
| 12704 | 1023 |
| 12705 | 1023 |
| 12706 | 1023 |
| 12707 | 1023 |
| 12708 | 1023 |
| 12709 | 1023 |
| 12710 | 1023 |
| 12711 | 1023 |
| 12712 | 1023 |
| 12713 | 0 |
| 12714 | 0 |
| 12715 | 0 |
| 12716 | 0 |
| 12717 | 0 |
| 12718 | 0 |
| 12719 | 0 |
| 12720 | 0 |
| 12721 | 0 |
| 12722 | 0 |
| 12723 | 0 |
| 12724 | 0 |
| 12725 | 0 |
| 12726 | 0 |
| 12727 | 1023 |
| 12728 | 1023 |
| 12729 | 1023 |
| 12730 | 1023 |
| 12731 | 1023 |
| 12732 | 1023 |
| 12733 | 1023 |
| 12734 | 1023 |
| 12735 | 1023 |
| 12736 | 1023 |
| 12737 | 1023 |
| 12738 | 1023 |
| 12739 | 1023 |
| 12740 | 1023 |
| 12741 | 1023 |
| 12742 | 1023 |
| 12743 | 1023 |
| 12744 | 1023 |
| 12745 | 1023 |
| 12746 | 1023 |
| 12747 | 1023 |
| 12748 | 1023 |
| 12749 | 1023 |
| 12750 | 1023 |
| 12751 | 1023 |
| 12752 | 1023 |
| 12753 | 1023 |
| 12754 | 1023 |
| 12755 | 1023 |
| 12756 | 1023 |
| 12757 | 1023 |
| 12758 | 1023 |
| 12759 | 1023 |
| 12760 | 1023 |
| 12761 | 1023 |
| 12762 | 1023 |
| 12763 | 1023 |
| 12764 | 0 |
| 12765 | 0 |
| 12766 | 0 |
| 12767 | 0 |
| 12768 | 0 |
| 12769 | 0 |
| 12770 | 0 |
| 12771 | 0 |
| 12772 | 0 |
| 12773 | 0 |
| 12774 | 0 |
| 12775 | 0 |
| 12776 | 0 |
| 12777 | 0 |
| 12778 | 0 |
| 12779 | 1023 |
| 12780 | 1023 |
| 12781 | 1023 |
| 12782 | 1023 |
| 12783 | 1023 |
| 12784 | 1023 |
| 12785 | 1023 |
| 12786 | 1023 |
| 12787 | 1023 |
| 12788 | 1023 |
| 12789 | 1023 |
| 12790 | 1023 |
| 12791 | 1023 |
| 12792 | 1023 |
| 12793 | 1023 |
| 12794 | 1023 |
| 12795 | 1023 |
| 12796 | 1023 |
| 12797 | 1023 |
| 12798 | 1023 |
| 12799 | 1023 |
| 12800 | 1023 |
| 12801 | 1023 |
| 12802 | 1023 |
| 12803 | 1023 |
| 12804 | 1023 |
| 12805 | 1023 |
| 12806 | 1023 |
| 12807 | 1023 |
| 12808 | 1023 |
| 12809 | 1023 |
| 12810 | 1023 |
| 12811 | 1023 |
| 12812 | 1023 |
| 12813 | 1023 |
| 12814 | 1023 |
| 12815 | 1023 |
| 12816 | 0 |
| 12817 | 0 |
| 12818 | 0 |
| 12819 | 0 |
| 12820 | 0 |
| 12821 | 0 |
| 12822 | 0 |
| 12823 | 1 |
| 12824 | 0 |
| 12825 | 0 |
| 12826 | 0 |
| 12827 | 0 |
| 12828 | 0 |
| 12829 | 0 |
| 12830 | 0 |
| 12831 | 1023 |
| 12832 | 1023 |
| 12833 | 1023 |
| 12834 | 1023 |
| 12835 | 1023 |
| 12836 | 1023 |
| 12837 | 1023 |
| 12838 | 1023 |
| 12839 | 1023 |
| 12840 | 1023 |
| 12841 | 1023 |
| 12842 | 1023 |
| 12843 | 1023 |
| 12844 | 1023 |
| 12845 | 1023 |
| 12846 | 1023 |
| 12847 | 1023 |
| 12848 | 1023 |
| 12849 | 1023 |
| 12850 | 1023 |
| 12851 | 1023 |
| 12852 | 1023 |
| 12853 | 1023 |
| 12854 | 1023 |
| 12855 | 1023 |
| 12856 | 1023 |
| 12857 | 1023 |
| 12858 | 1023 |
| 12859 | 1023 |
| 12860 | 1023 |
| 12861 | 1023 |
| 12862 | 1023 |
| 12863 | 1023 |
| 12864 | 1023 |
| 12865 | 1023 |
| 12866 | 1023 |
| 12867 | 1023 |
| 12868 | 1023 |
| 12869 | 0 |
| 12870 | 0 |
| 12871 | 0 |
| 12872 | 0 |
| 12873 | 0 |
| 12874 | 0 |
| 12875 | 0 |
| 12876 | 0 |
| 12877 | 0 |
| 12878 | 0 |
| 12879 | 0 |
| 12880 | 0 |
| 12881 | 0 |
| 12882 | 1023 |
| 12883 | 1023 |
| 12884 | 1023 |
| 12885 | 1023 |
| 12886 | 1023 |
| 12887 | 1023 |
| 12888 | 1023 |
| 12889 | 1023 |
| 12890 | 1023 |
| 12891 | 1023 |
| 12892 | 1023 |
| 12893 | 1023 |
| 12894 | 1023 |
| 12895 | 1023 |
| 12896 | 1023 |
| 12897 | 1023 |
| 12898 | 1023 |
| 12899 | 1023 |
| 12900 | 1023 |
| 12901 | 1023 |
| 12902 | 1023 |
| 12903 | 1023 |
| 12904 | 1023 |
| 12905 | 1023 |
| 12906 | 1023 |
| 12907 | 1023 |
| 12908 | 1023 |
| 12909 | 1023 |
| 12910 | 1023 |
| 12911 | 1023 |
| 12912 | 1023 |
| 12913 | 1023 |
| 12914 | 1023 |
| 12915 | 1023 |
| 12916 | 1023 |
| 12917 | 1023 |
| 12918 | 1023 |
| 12919 | 1023 |
| 12920 | 0 |
| 12921 | 0 |
| 12922 | 0 |
| 12923 | 0 |
| 12924 | 0 |
| 12925 | 0 |
| 12926 | 0 |
| 12927 | 0 |
| 12928 | 0 |
| 12929 | 0 |
| 12930 | 0 |
| 12931 | 0 |
| 12932 | 0 |
| 12933 | 1023 |
| 12934 | 1023 |
| 12935 | 1023 |
| 12936 | 1023 |
| 12937 | 1023 |
| 12938 | 1023 |
| 12939 | 1023 |
| 12940 | 1023 |
| 12941 | 1023 |
| 12942 | 1023 |
| 12943 | 1023 |
| 12944 | 1023 |
| 12945 | 1023 |
| 12946 | 1023 |
| 12947 | 1023 |
| 12948 | 1023 |
| 12949 | 1023 |
| 12950 | 1023 |
| 12951 | 1023 |
| 12952 | 1023 |
| 12953 | 1023 |
| 12954 | 1023 |
| 12955 | 1023 |
| 12956 | 1023 |
| 12957 | 1023 |
| 12958 | 1023 |
| 12959 | 1023 |
| 12960 | 1023 |
| 12961 | 1023 |
| 12962 | 1023 |
| 12963 | 1023 |
| 12964 | 1023 |
| 12965 | 1023 |
| 12966 | 1023 |
| 12967 | 1023 |
| 12968 | 1023 |
| 12969 | 1023 |
| 12970 | 1023 |
| 12971 | 0 |
| 12972 | 0 |
| 12973 | 0 |
| 12974 | 0 |
| 12975 | 0 |
| 12976 | 0 |
| 12977 | 0 |
| 12978 | 0 |
| 12979 | 0 |
| 12980 | 0 |
| 12981 | 0 |
| 12982 | 0 |
| 12983 | 0 |
| 12984 | 1023 |
| 12985 | 1023 |
| 12986 | 1023 |
| 12987 | 1023 |
| 12988 | 1023 |
| 12989 | 1023 |
| 12990 | 1023 |
| 12991 | 1023 |
| 12992 | 1023 |
| 12993 | 1023 |
| 12994 | 1023 |
| 12995 | 1023 |
| 12996 | 1023 |
| 12997 | 1023 |
| 12998 | 1023 |
| 12999 | 1023 |
| 13000 | 1023 |
| 13001 | 1023 |
| 13002 | 1023 |
| 13003 | 1023 |
| 13004 | 1023 |
| 13005 | 1023 |
| 13006 | 1023 |
| 13007 | 1023 |
| 13008 | 1023 |
| 13009 | 1023 |
| 13010 | 1023 |
| 13011 | 1023 |
| 13012 | 1023 |
| 13013 | 1023 |
| 13014 | 1023 |
| 13015 | 1023 |
| 13016 | 1023 |
| 13017 | 1023 |
| 13018 | 1023 |
| 13019 | 1023 |
| 13020 | 1023 |
| 13021 | 1023 |
| 13022 | 0 |
| 13023 | 0 |
| 13024 | 0 |
| 13025 | 0 |
| 13026 | 0 |
| 13027 | 0 |
| 13028 | 0 |
| 13029 | 0 |
| 13030 | 0 |
| 13031 | 0 |
| 13032 | 0 |
| 13033 | 0 |
| 13034 | 0 |
| 13035 | 1023 |
| 13036 | 1023 |
| 13037 | 1023 |
| 13038 | 1023 |
| 13039 | 1023 |
| 13040 | 1023 |
| 13041 | 1023 |
| 13042 | 1023 |
| 13043 | 1023 |
| 13044 | 1023 |
| 13045 | 1023 |
| 13046 | 1023 |
| 13047 | 1023 |
| 13048 | 1023 |
| 13049 | 1023 |
| 13050 | 1023 |
| 13051 | 1023 |
| 13052 | 1023 |
| 13053 | 1023 |
| 13054 | 1023 |
| 13055 | 1023 |
| 13056 | 1023 |
| 13057 | 1023 |
| 13058 | 1023 |
| 13059 | 1023 |
| 13060 | 1023 |
| 13061 | 1023 |
| 13062 | 1023 |
| 13063 | 1023 |
| 13064 | 1023 |
| 13065 | 1023 |
| 13066 | 1023 |
| 13067 | 1023 |
| 13068 | 1023 |
| 13069 | 1023 |
| 13070 | 1023 |
| 13071 | 1023 |
| 13072 | 1023 |
| 13073 | 0 |
| 13074 | 0 |
| 13075 | 0 |
| 13076 | 0 |
| 13077 | 0 |
| 13078 | 0 |
| 13079 | 0 |
| 13080 | 0 |
| 13081 | 0 |
| 13082 | 0 |
| 13083 | 0 |
| 13084 | 0 |
| 13085 | 0 |
| 13086 | 1023 |
| 13087 | 1023 |
| 13088 | 1023 |
| 13089 | 1023 |
| 13090 | 1023 |
| 13091 | 1023 |
| 13092 | 1023 |
| 13093 | 1023 |
| 13094 | 1023 |
| 13095 | 1023 |
| 13096 | 1023 |
| 13097 | 1023 |
| 13098 | 1023 |
| 13099 | 1023 |
| 13100 | 1023 |
| 13101 | 1023 |
| 13102 | 1023 |
| 13103 | 1023 |
| 13104 | 1023 |
| 13105 | 1023 |
| 13106 | 1023 |
| 13107 | 1023 |
| 13108 | 1023 |
| 13109 | 1023 |
| 13110 | 1023 |
| 13111 | 1023 |
| 13112 | 1023 |
| 13113 | 1023 |
| 13114 | 1023 |
| 13115 | 1023 |
| 13116 | 1023 |
| 13117 | 1023 |
| 13118 | 1023 |
| 13119 | 1023 |
| 13120 | 1023 |
| 13121 | 1023 |
| 13122 | 1023 |
| 13123 | 1023 |
| 13124 | 0 |
| 13125 | 0 |
| 13126 | 0 |
| 13127 | 0 |
| 13128 | 0 |
| 13129 | 0 |
| 13130 | 0 |
| 13131 | 0 |
| 13132 | 0 |
| 13133 | 0 |
| 13134 | 0 |
| 13135 | 0 |
| 13136 | 0 |
| 13137 | 1023 |
| 13138 | 1023 |
| 13139 | 1023 |
| 13140 | 1023 |
| 13141 | 1023 |
| 13142 | 1023 |
| 13143 | 1023 |
| 13144 | 1023 |
| 13145 | 1023 |
| 13146 | 1023 |
| 13147 | 1023 |
| 13148 | 1023 |
| 13149 | 1023 |
| 13150 | 1023 |
| 13151 | 1023 |
| 13152 | 1023 |
| 13153 | 1023 |
| 13154 | 1023 |
| 13155 | 1023 |
| 13156 | 1023 |
| 13157 | 1023 |
| 13158 | 1023 |
| 13159 | 1023 |
| 13160 | 1023 |
| 13161 | 1023 |
| 13162 | 1023 |
| 13163 | 1023 |
| 13164 | 1023 |
| 13165 | 1023 |
| 13166 | 1023 |
| 13167 | 1023 |
| 13168 | 1023 |
| 13169 | 1023 |
| 13170 | 1023 |
| 13171 | 1023 |
| 13172 | 1023 |
| 13173 | 1023 |
| 13174 | 1023 |
| 13175 | 0 |
| 13176 | 0 |
| 13177 | 0 |
| 13178 | 0 |
| 13179 | 0 |
| 13180 | 0 |
| 13181 | 0 |
| 13182 | 0 |
| 13183 | 0 |
| 13184 | 0 |
| 13185 | 0 |
| 13186 | 0 |
| 13187 | 0 |
| 13188 | 1023 |
| 13189 | 1023 |
| 13190 | 1023 |
| 13191 | 1023 |
| 13192 | 1023 |
| 13193 | 1023 |
| 13194 | 1023 |
| 13195 | 1023 |
| 13196 | 1023 |
| 13197 | 1023 |
| 13198 | 1023 |
| 13199 | 1023 |
| 13200 | 1023 |
| 13201 | 1023 |
| 13202 | 1023 |
| 13203 | 1023 |
| 13204 | 1023 |
| 13205 | 1023 |
| 13206 | 1023 |
| 13207 | 1023 |
| 13208 | 1023 |
| 13209 | 1023 |
| 13210 | 1023 |
| 13211 | 1023 |
| 13212 | 1023 |
| 13213 | 1023 |
| 13214 | 1023 |
| 13215 | 1023 |
| 13216 | 1023 |
| 13217 | 1023 |
| 13218 | 1023 |
| 13219 | 1023 |
| 13220 | 1023 |
| 13221 | 1023 |
| 13222 | 1023 |
| 13223 | 1023 |
| 13224 | 1023 |
| 13225 | 1023 |
| 13226 | 0 |
| 13227 | 0 |
| 13228 | 0 |
| 13229 | 0 |
| 13230 | 0 |
| 13231 | 0 |
| 13232 | 0 |
| 13233 | 0 |
| 13234 | 0 |
| 13235 | 0 |
| 13236 | 0 |
| 13237 | 0 |
| 13238 | 0 |
| 13239 | 0 |
| 13240 | 1023 |
| 13241 | 1023 |
| 13242 | 1023 |
| 13243 | 1023 |
| 13244 | 1023 |
| 13245 | 1023 |
| 13246 | 1023 |
| 13247 | 1023 |
| 13248 | 1023 |
| 13249 | 1023 |
| 13250 | 1023 |
| 13251 | 1023 |
| 13252 | 1023 |
| 13253 | 1023 |
| 13254 | 1023 |
| 13255 | 1023 |
| 13256 | 1023 |
| 13257 | 1023 |
| 13258 | 1023 |
| 13259 | 1023 |
| 13260 | 1023 |
| 13261 | 1023 |
| 13262 | 1023 |
| 13263 | 1023 |
| 13264 | 1023 |
| 13265 | 1023 |
| 13266 | 1023 |
| 13267 | 1023 |
| 13268 | 1023 |
| 13269 | 1023 |
| 13270 | 1023 |
| 13271 | 1023 |
| 13272 | 1023 |
| 13273 | 1023 |
| 13274 | 1023 |
| 13275 | 1023 |
| 13276 | 1023 |
| 13277 | 0 |
| 13278 | 0 |
| 13279 | 0 |
| 13280 | 0 |
| 13281 | 0 |
| 13282 | 0 |
| 13283 | 0 |
| 13284 | 0 |
| 13285 | 0 |
| 13286 | 0 |
| 13287 | 0 |
| 13288 | 0 |
| 13289 | 0 |
| 13290 | 0 |
| 13291 | 0 |
| 13292 | 1023 |
| 13293 | 1023 |
| 13294 | 1023 |
| 13295 | 1023 |
| 13296 | 1023 |
| 13297 | 1023 |
| 13298 | 1023 |
| 13299 | 1023 |
| 13300 | 1023 |
| 13301 | 1023 |
| 13302 | 1023 |
| 13303 | 1023 |
| 13304 | 1023 |
| 13305 | 1023 |
| 13306 | 1023 |
| 13307 | 1023 |
| 13308 | 1023 |
| 13309 | 1023 |
| 13310 | 1023 |
| 13311 | 1023 |
| 13312 | 1023 |
| 13313 | 1023 |
| 13314 | 1023 |
| 13315 | 1023 |
| 13316 | 1023 |
| 13317 | 1023 |
| 13318 | 1023 |
| 13319 | 1023 |
| 13320 | 1023 |
| 13321 | 1023 |
| 13322 | 1023 |
| 13323 | 1023 |
| 13324 | 1023 |
| 13325 | 1023 |
| 13326 | 1023 |
| 13327 | 1023 |
| 13328 | 1023 |
| 13329 | 0 |
| 13330 | 0 |
| 13331 | 0 |
| 13332 | 0 |
| 13333 | 0 |
| 13334 | 0 |
| 13335 | 0 |
| 13336 | 0 |
| 13337 | 0 |
| 13338 | 0 |
| 13339 | 0 |
| 13340 | 0 |
| 13341 | 1 |
| 13342 | 0 |
| 13343 | 0 |
| 13344 | 1023 |
| 13345 | 1023 |
| 13346 | 1023 |
| 13347 | 1023 |
| 13348 | 1023 |
| 13349 | 1023 |
| 13350 | 1023 |
| 13351 | 1023 |
| 13352 | 1023 |
| 13353 | 1023 |
| 13354 | 1023 |
| 13355 | 1023 |
| 13356 | 1023 |
| 13357 | 1023 |
| 13358 | 1023 |
| 13359 | 1023 |
| 13360 | 1023 |
| 13361 | 1023 |
| 13362 | 1023 |
| 13363 | 1023 |
| 13364 | 1023 |
| 13365 | 1023 |
| 13366 | 1023 |
| 13367 | 1023 |
| 13368 | 1023 |
| 13369 | 1023 |
| 13370 | 1023 |
| 13371 | 1023 |
| 13372 | 1023 |
| 13373 | 1023 |
| 13374 | 1023 |
| 13375 | 1023 |
| 13376 | 1023 |
| 13377 | 1023 |
| 13378 | 1023 |
| 13379 | 1023 |
| 13380 | 1023 |
| 13381 | 0 |
| 13382 | 0 |
| 13383 | 0 |
| 13384 | 0 |
| 13385 | 0 |
| 13386 | 0 |
| 13387 | 0 |
| 13388 | 0 |
| 13389 | 0 |
| 13390 | 0 |
| 13391 | 0 |
| 13392 | 0 |
| 13393 | 0 |
| 13394 | 0 |
| 13395 | 0 |
| 13396 | 1023 |
| 13397 | 1023 |
| 13398 | 1023 |
| 13399 | 1023 |
| 13400 | 1023 |
| 13401 | 1023 |
| 13402 | 1023 |
| 13403 | 1023 |
| 13404 | 1023 |
| 13405 | 1023 |
| 13406 | 1023 |
| 13407 | 1023 |
| 13408 | 1023 |
| 13409 | 1023 |
| 13410 | 1023 |
| 13411 | 1023 |
| 13412 | 1023 |
| 13413 | 1023 |
| 13414 | 1023 |
| 13415 | 1023 |
| 13416 | 1023 |
| 13417 | 1023 |
| 13418 | 1023 |
| 13419 | 1023 |
| 13420 | 1023 |
| 13421 | 1023 |
| 13422 | 1023 |
| 13423 | 1023 |
| 13424 | 1023 |
| 13425 | 1023 |
| 13426 | 1023 |
| 13427 | 1023 |
| 13428 | 1023 |
| 13429 | 1023 |
| 13430 | 1023 |
| 13431 | 1023 |
| 13432 | 1023 |
| 13433 | 0 |
| 13434 | 0 |
| 13435 | 0 |
| 13436 | 0 |
| 13437 | 0 |
| 13438 | 0 |
| 13439 | 0 |
| 13440 | 0 |
| 13441 | 0 |
| 13442 | 0 |
| 13443 | 0 |
| 13444 | 0 |
| 13445 | 0 |
| 13446 | 0 |
| 13447 | 0 |
| 13448 | 1023 |
| 13449 | 1023 |
| 13450 | 1023 |
| 13451 | 1023 |
| 13452 | 1023 |
| 13453 | 1023 |
| 13454 | 1023 |
| 13455 | 1023 |
| 13456 | 1023 |
| 13457 | 1023 |
| 13458 | 1023 |
| 13459 | 1023 |
| 13460 | 1023 |
| 13461 | 1023 |
| 13462 | 1023 |
| 13463 | 1023 |
| 13464 | 1023 |
| 13465 | 1023 |
| 13466 | 1023 |
| 13467 | 1023 |
| 13468 | 1023 |
| 13469 | 1023 |
| 13470 | 1023 |
| 13471 | 1023 |
| 13472 | 1023 |
| 13473 | 1023 |
| 13474 | 1023 |
| 13475 | 1023 |
| 13476 | 1023 |
| 13477 | 1023 |
| 13478 | 1023 |
| 13479 | 1023 |
| 13480 | 1023 |
| 13481 | 1023 |
| 13482 | 1023 |
| 13483 | 1023 |
| 13484 | 1023 |
| 13485 | 1023 |
| 13486 | 0 |
| 13487 | 0 |
| 13488 | 0 |
| 13489 | 0 |
| 13490 | 0 |
| 13491 | 0 |
| 13492 | 0 |
| 13493 | 0 |
| 13494 | 0 |
| 13495 | 0 |
| 13496 | 0 |
| 13497 | 0 |
| 13498 | 0 |
| 13499 | 1023 |
| 13500 | 1023 |
| 13501 | 1023 |
| 13502 | 1023 |
| 13503 | 1023 |
| 13504 | 1023 |
| 13505 | 1023 |
| 13506 | 1023 |
| 13507 | 1023 |
| 13508 | 1023 |
| 13509 | 1023 |
| 13510 | 1023 |
| 13511 | 1023 |
| 13512 | 1023 |
| 13513 | 1023 |
| 13514 | 1023 |
| 13515 | 1023 |
| 13516 | 1023 |
| 13517 | 1023 |
| 13518 | 1023 |
| 13519 | 1023 |
| 13520 | 1023 |
| 13521 | 1023 |
| 13522 | 1023 |
| 13523 | 1023 |
| 13524 | 1023 |
| 13525 | 1023 |
| 13526 | 1023 |
| 13527 | 1023 |
| 13528 | 1023 |
| 13529 | 1023 |
| 13530 | 1023 |
| 13531 | 1023 |
| 13532 | 1023 |
| 13533 | 1023 |
| 13534 | 1023 |
| 13535 | 1023 |
| 13536 | 1023 |
| 13537 | 0 |
| 13538 | 0 |
| 13539 | 0 |
| 13540 | 0 |
| 13541 | 0 |
| 13542 | 0 |
| 13543 | 0 |
| 13544 | 0 |
| 13545 | 0 |
| 13546 | 0 |
| 13547 | 0 |
| 13548 | 0 |
| 13549 | 0 |
| 13550 | 1023 |
| 13551 | 1023 |
| 13552 | 1023 |
| 13553 | 1023 |
| 13554 | 1023 |
| 13555 | 1023 |
| 13556 | 1023 |
| 13557 | 1023 |
| 13558 | 1023 |
| 13559 | 1023 |
| 13560 | 1023 |
| 13561 | 1023 |
| 13562 | 1023 |
| 13563 | 1023 |
| 13564 | 1023 |
| 13565 | 1023 |
| 13566 | 1023 |
| 13567 | 1023 |
| 13568 | 1023 |
| 13569 | 1023 |
| 13570 | 1023 |
| 13571 | 1023 |
| 13572 | 1023 |
| 13573 | 1023 |
| 13574 | 1023 |
| 13575 | 1023 |
| 13576 | 1023 |
| 13577 | 1023 |
| 13578 | 1023 |
| 13579 | 1023 |
| 13580 | 1023 |
| 13581 | 1023 |
| 13582 | 1023 |
| 13583 | 1023 |
| 13584 | 1023 |
| 13585 | 1023 |
| 13586 | 1023 |
| 13587 | 1023 |
| 13588 | 0 |
| 13589 | 0 |
| 13590 | 0 |
| 13591 | 0 |
| 13592 | 0 |
| 13593 | 0 |
| 13594 | 0 |
| 13595 | 0 |
| 13596 | 0 |
| 13597 | 0 |
| 13598 | 0 |
| 13599 | 0 |
| 13600 | 0 |
| 13601 | 1023 |
| 13602 | 1023 |
| 13603 | 1023 |
| 13604 | 1023 |
| 13605 | 1023 |
| 13606 | 1023 |
| 13607 | 1023 |
| 13608 | 1023 |
| 13609 | 1023 |
| 13610 | 1023 |
| 13611 | 1023 |
| 13612 | 1023 |
| 13613 | 1023 |
| 13614 | 1023 |
| 13615 | 1023 |
| 13616 | 1023 |
| 13617 | 1023 |
| 13618 | 1023 |
| 13619 | 1023 |
| 13620 | 1023 |
| 13621 | 1023 |
| 13622 | 1023 |
| 13623 | 1023 |
| 13624 | 1023 |
| 13625 | 1023 |
| 13626 | 1023 |
| 13627 | 1023 |
| 13628 | 1023 |
| 13629 | 1023 |
| 13630 | 1023 |
| 13631 | 1023 |
| 13632 | 1023 |
| 13633 | 1023 |
| 13634 | 1023 |
| 13635 | 1023 |
| 13636 | 1023 |
| 13637 | 1023 |
| 13638 | 1023 |
| 13639 | 0 |
| 13640 | 0 |
| 13641 | 0 |
| 13642 | 0 |
| 13643 | 0 |
| 13644 | 0 |
| 13645 | 0 |
| 13646 | 0 |
| 13647 | 0 |
| 13648 | 0 |
| 13649 | 0 |
| 13650 | 0 |
| 13651 | 0 |
| 13652 | 1023 |
| 13653 | 1023 |
| 13654 | 1023 |
| 13655 | 1023 |
| 13656 | 1023 |
| 13657 | 1023 |
| 13658 | 1023 |
| 13659 | 1023 |
| 13660 | 1023 |
| 13661 | 1023 |
| 13662 | 1023 |
| 13663 | 1023 |
| 13664 | 1023 |
| 13665 | 1023 |
| 13666 | 1023 |
| 13667 | 1023 |
| 13668 | 1023 |
| 13669 | 1023 |
| 13670 | 1023 |
| 13671 | 1023 |
| 13672 | 1023 |
| 13673 | 1023 |
| 13674 | 1023 |
| 13675 | 1023 |
| 13676 | 1023 |
| 13677 | 1023 |
| 13678 | 1023 |
| 13679 | 1023 |
| 13680 | 1023 |
| 13681 | 1023 |
| 13682 | 1023 |
| 13683 | 1023 |
| 13684 | 1023 |
| 13685 | 1023 |
| 13686 | 1023 |
| 13687 | 1023 |
| 13688 | 1023 |
| 13689 | 1023 |
| 13690 | 0 |
| 13691 | 0 |
| 13692 | 0 |
| 13693 | 0 |
| 13694 | 0 |
| 13695 | 0 |
| 13696 | 0 |
| 13697 | 0 |
| 13698 | 0 |
| 13699 | 0 |
| 13700 | 0 |
| 13701 | 0 |
| 13702 | 0 |
| 13703 | 1023 |
| 13704 | 1023 |
| 13705 | 1023 |
| 13706 | 1023 |
| 13707 | 1023 |
| 13708 | 1023 |
| 13709 | 1023 |
| 13710 | 1023 |
| 13711 | 1023 |
| 13712 | 1023 |
| 13713 | 1023 |
| 13714 | 1023 |
| 13715 | 1023 |
| 13716 | 1023 |
| 13717 | 1023 |
| 13718 | 1023 |
| 13719 | 1023 |
| 13720 | 1023 |
| 13721 | 1023 |
| 13722 | 1023 |
| 13723 | 1023 |
| 13724 | 1023 |
| 13725 | 1023 |
| 13726 | 1023 |
| 13727 | 1023 |
| 13728 | 1023 |
| 13729 | 1023 |
| 13730 | 1023 |
| 13731 | 1023 |
| 13732 | 1023 |
| 13733 | 1023 |
| 13734 | 1023 |
| 13735 | 1023 |
| 13736 | 1023 |
| 13737 | 1023 |
| 13738 | 1023 |
| 13739 | 1023 |
| 13740 | 1023 |
| 13741 | 0 |
| 13742 | 0 |
| 13743 | 0 |
| 13744 | 0 |
| 13745 | 0 |
| 13746 | 0 |
| 13747 | 0 |
| 13748 | 0 |
| 13749 | 0 |
| 13750 | 0 |
| 13751 | 0 |
| 13752 | 0 |
| 13753 | 0 |
| 13754 | 1023 |
| 13755 | 1023 |
| 13756 | 1023 |
| 13757 | 1023 |
| 13758 | 1023 |
| 13759 | 1023 |
| 13760 | 1023 |
| 13761 | 1023 |
| 13762 | 1023 |
| 13763 | 1023 |
| 13764 | 1023 |
| 13765 | 1023 |
| 13766 | 1023 |
| 13767 | 1023 |
| 13768 | 1023 |
| 13769 | 1023 |
| 13770 | 1023 |
| 13771 | 1023 |
| 13772 | 1023 |
| 13773 | 1023 |
| 13774 | 1023 |
| 13775 | 1023 |
| 13776 | 1023 |
| 13777 | 1023 |
| 13778 | 1023 |
| 13779 | 1023 |
| 13780 | 1023 |
| 13781 | 1023 |
| 13782 | 1023 |
| 13783 | 1023 |
| 13784 | 1023 |
| 13785 | 1023 |
| 13786 | 1023 |
| 13787 | 1023 |
| 13788 | 1023 |
| 13789 | 1023 |
| 13790 | 1023 |
| 13791 | 1023 |
| 13792 | 0 |
| 13793 | 0 |
| 13794 | 0 |
| 13795 | 0 |
| 13796 | 0 |
| 13797 | 0 |
| 13798 | 0 |
| 13799 | 0 |
| 13800 | 0 |
| 13801 | 0 |
| 13802 | 0 |
| 13803 | 0 |
| 13804 | 0 |
| 13805 | 0 |
| 13806 | 1023 |
| 13807 | 1023 |
| 13808 | 1023 |
| 13809 | 1023 |
| 13810 | 1023 |
| 13811 | 1023 |
| 13812 | 1023 |
| 13813 | 1023 |
| 13814 | 1023 |
| 13815 | 1023 |
| 13816 | 1023 |
| 13817 | 1023 |
| 13818 | 1023 |
| 13819 | 1023 |
| 13820 | 1023 |
| 13821 | 1023 |
| 13822 | 1023 |
| 13823 | 1023 |
| 13824 | 1023 |
| 13825 | 1023 |
| 13826 | 1023 |
| 13827 | 1023 |
| 13828 | 1023 |
| 13829 | 1023 |
| 13830 | 1023 |
| 13831 | 1023 |
| 13832 | 1023 |
| 13833 | 1023 |
| 13834 | 1023 |
| 13835 | 1023 |
| 13836 | 1023 |
| 13837 | 1023 |
| 13838 | 1023 |
| 13839 | 1023 |
| 13840 | 1023 |
| 13841 | 1023 |
| 13842 | 1023 |
| 13843 | 0 |
| 13844 | 0 |
| 13845 | 0 |
| 13846 | 0 |
| 13847 | 0 |
| 13848 | 0 |
| 13849 | 0 |
| 13850 | 0 |
| 13851 | 0 |
| 13852 | 0 |
| 13853 | 0 |
| 13854 | 0 |
| 13855 | 0 |
| 13856 | 0 |
| 13857 | 1023 |
| 13858 | 1023 |
| 13859 | 1023 |
| 13860 | 1023 |
| 13861 | 1023 |
| 13862 | 1023 |
| 13863 | 1023 |
| 13864 | 1023 |
| 13865 | 1023 |
| 13866 | 1023 |
| 13867 | 1023 |
| 13868 | 1023 |
| 13869 | 1023 |
| 13870 | 1023 |
| 13871 | 1023 |
| 13872 | 1023 |
| 13873 | 1023 |
| 13874 | 1023 |
| 13875 | 1023 |
| 13876 | 1023 |
| 13877 | 1023 |
| 13878 | 1023 |
| 13879 | 1023 |
| 13880 | 1023 |
| 13881 | 1023 |
| 13882 | 1023 |
| 13883 | 1023 |
| 13884 | 1023 |
| 13885 | 1023 |
| 13886 | 1023 |
| 13887 | 1023 |
| 13888 | 1023 |
| 13889 | 1023 |
| 13890 | 1023 |
| 13891 | 1023 |
| 13892 | 1023 |
| 13893 | 1023 |
| 13894 | 1023 |
| 13895 | 0 |
| 13896 | 0 |
| 13897 | 0 |
| 13898 | 0 |
| 13899 | 0 |
| 13900 | 0 |
| 13901 | 0 |
| 13902 | 0 |
| 13903 | 0 |
| 13904 | 0 |
| 13905 | 0 |
| 13906 | 0 |
| 13907 | 0 |
| 13908 | 0 |
| 13909 | 1023 |
| 13910 | 1023 |
| 13911 | 1023 |
| 13912 | 1023 |
| 13913 | 1023 |
| 13914 | 1023 |
| 13915 | 1023 |
| 13916 | 1023 |
| 13917 | 1023 |
| 13918 | 1023 |
| 13919 | 1023 |
| 13920 | 1023 |
| 13921 | 1023 |
| 13922 | 1023 |
| 13923 | 1023 |
| 13924 | 1023 |
| 13925 | 1023 |
| 13926 | 1023 |
| 13927 | 1023 |
| 13928 | 1023 |
| 13929 | 1023 |
| 13930 | 1023 |
| 13931 | 1023 |
| 13932 | 1023 |
| 13933 | 1023 |
| 13934 | 1023 |
| 13935 | 1023 |
| 13936 | 1023 |
| 13937 | 1023 |
| 13938 | 1023 |
| 13939 | 1023 |
| 13940 | 1023 |
| 13941 | 1023 |
| 13942 | 1023 |
| 13943 | 1023 |
| 13944 | 1023 |
| 13945 | 1023 |
| 13946 | 0 |
| 13947 | 0 |
| 13948 | 0 |
| 13949 | 0 |
| 13950 | 0 |
| 13951 | 0 |
| 13952 | 0 |
| 13953 | 0 |
| 13954 | 0 |
| 13955 | 0 |
| 13956 | 0 |
| 13957 | 0 |
| 13958 | 0 |
| 13959 | 0 |
| 13960 | 0 |
| 13961 | 1023 |
| 13962 | 1023 |
| 13963 | 1023 |
| 13964 | 1023 |
| 13965 | 1023 |
| 13966 | 1023 |
| 13967 | 1023 |
| 13968 | 1023 |
| 13969 | 1023 |
| 13970 | 1023 |
| 13971 | 1023 |
| 13972 | 1023 |
| 13973 | 1023 |
| 13974 | 1023 |
| 13975 | 1023 |
| 13976 | 1023 |
| 13977 | 1023 |
| 13978 | 1023 |
| 13979 | 1023 |
| 13980 | 1023 |
| 13981 | 1023 |
| 13982 | 1023 |
| 13983 | 1023 |
| 13984 | 1023 |
| 13985 | 1023 |
| 13986 | 1023 |
| 13987 | 1023 |
| 13988 | 1023 |
| 13989 | 1023 |
| 13990 | 1023 |
| 13991 | 1023 |
| 13992 | 1023 |
| 13993 | 1023 |
| 13994 | 1023 |
| 13995 | 1023 |
| 13996 | 1023 |
| 13997 | 1023 |
| 13998 | 0 |
| 13999 | 0 |
| 14000 | 0 |
| 14001 | 0 |
| 14002 | 0 |
| 14003 | 0 |
| 14004 | 0 |
| 14005 | 0 |
| 14006 | 0 |
| 14007 | 0 |
| 14008 | 0 |
| 14009 | 0 |
| 14010 | 0 |
| 14011 | 0 |
| 14012 | 0 |
| 14013 | 1023 |
| 14014 | 1023 |
| 14015 | 1023 |
| 14016 | 1023 |
| 14017 | 1023 |
| 14018 | 1023 |
| 14019 | 1023 |
| 14020 | 1023 |
| 14021 | 1023 |
| 14022 | 1023 |
| 14023 | 1023 |
| 14024 | 1023 |
| 14025 | 1023 |
| 14026 | 1023 |
| 14027 | 1023 |
| 14028 | 1023 |
| 14029 | 1023 |
| 14030 | 1023 |
| 14031 | 1023 |
| 14032 | 1023 |
| 14033 | 1023 |
| 14034 | 1023 |
| 14035 | 1023 |
| 14036 | 1023 |
| 14037 | 1023 |
| 14038 | 1023 |
| 14039 | 1023 |
| 14040 | 1023 |
| 14041 | 1023 |
| 14042 | 1023 |
| 14043 | 1023 |
| 14044 | 1023 |
| 14045 | 1023 |
| 14046 | 1023 |
| 14047 | 1023 |
| 14048 | 1023 |
| 14049 | 1023 |
| 14050 | 319 |
| 14051 | 0 |
| 14052 | 0 |
| 14053 | 0 |
| 14054 | 0 |
| 14055 | 0 |
| 14056 | 0 |
| 14057 | 0 |
| 14058 | 0 |
| 14059 | 0 |
| 14060 | 0 |
| 14061 | 0 |
| 14062 | 0 |
| 14063 | 0 |
| 14064 | 1023 |
| 14065 | 1023 |
| 14066 | 1023 |
| 14067 | 1023 |
| 14068 | 1023 |
| 14069 | 1023 |
| 14070 | 1023 |
| 14071 | 1023 |
| 14072 | 1023 |
| 14073 | 1023 |
| 14074 | 1023 |
| 14075 | 1023 |
| 14076 | 1023 |
| 14077 | 1023 |
| 14078 | 1023 |
| 14079 | 1023 |
| 14080 | 1023 |
| 14081 | 1023 |
| 14082 | 1023 |
| 14083 | 1023 |
| 14084 | 1023 |
| 14085 | 1023 |
| 14086 | 1023 |
| 14087 | 1023 |
| 14088 | 1023 |
| 14089 | 1023 |
| 14090 | 1023 |
| 14091 | 1023 |
| 14092 | 1023 |
| 14093 | 1023 |
| 14094 | 1023 |
| 14095 | 1023 |
| 14096 | 1023 |
| 14097 | 1023 |
| 14098 | 1023 |
| 14099 | 1023 |
| 14100 | 1023 |
| 14101 | 1023 |
| 14102 | 0 |
| 14103 | 0 |
| 14104 | 0 |
| 14105 | 0 |
| 14106 | 0 |
| 14107 | 0 |
| 14108 | 0 |
| 14109 | 0 |
| 14110 | 0 |
| 14111 | 0 |
| 14112 | 0 |
| 14113 | 0 |
| 14114 | 0 |
| 14115 | 1023 |
| 14116 | 1023 |
| 14117 | 1023 |
| 14118 | 1023 |
| 14119 | 1023 |
| 14120 | 1023 |
| 14121 | 1023 |
| 14122 | 1023 |
| 14123 | 1023 |
| 14124 | 1023 |
| 14125 | 1023 |
| 14126 | 1023 |
| 14127 | 1023 |
| 14128 | 1023 |
| 14129 | 1023 |
| 14130 | 1023 |
| 14131 | 1023 |
| 14132 | 1023 |
| 14133 | 1023 |
| 14134 | 1023 |
| 14135 | 1023 |
| 14136 | 1023 |
| 14137 | 1023 |
| 14138 | 1023 |
| 14139 | 1023 |
| 14140 | 1023 |
| 14141 | 1023 |
| 14142 | 1023 |
| 14143 | 1023 |
| 14144 | 1023 |
| 14145 | 1023 |
| 14146 | 1023 |
| 14147 | 1023 |
| 14148 | 1023 |
| 14149 | 1023 |
| 14150 | 1023 |
| 14151 | 1023 |
| 14152 | 1023 |
| 14153 | 0 |
| 14154 | 0 |
| 14155 | 0 |
| 14156 | 0 |
| 14157 | 0 |
| 14158 | 0 |
| 14159 | 0 |
| 14160 | 0 |
| 14161 | 0 |
| 14162 | 0 |
| 14163 | 0 |
| 14164 | 0 |
| 14165 | 0 |
| 14166 | 1023 |
| 14167 | 1023 |
| 14168 | 1023 |
| 14169 | 1023 |
| 14170 | 1023 |
| 14171 | 1023 |
| 14172 | 1023 |
| 14173 | 1023 |
| 14174 | 1023 |
| 14175 | 1023 |
| 14176 | 1023 |
| 14177 | 1023 |
| 14178 | 1023 |
| 14179 | 1023 |
| 14180 | 1023 |
| 14181 | 1023 |
| 14182 | 1023 |
| 14183 | 1023 |
| 14184 | 1023 |
| 14185 | 1023 |
| 14186 | 1023 |
| 14187 | 1023 |
| 14188 | 1023 |
| 14189 | 1023 |
| 14190 | 1023 |
| 14191 | 1023 |
| 14192 | 1023 |
| 14193 | 1023 |
| 14194 | 1023 |
| 14195 | 1023 |
| 14196 | 1023 |
| 14197 | 1023 |
| 14198 | 1023 |
| 14199 | 1023 |
| 14200 | 1023 |
| 14201 | 1023 |
| 14202 | 1023 |
| 14203 | 1023 |
| 14204 | 0 |
| 14205 | 0 |
| 14206 | 0 |
| 14207 | 0 |
| 14208 | 0 |
| 14209 | 0 |
| 14210 | 0 |
| 14211 | 0 |
| 14212 | 0 |
| 14213 | 0 |
| 14214 | 0 |
| 14215 | 0 |
| 14216 | 0 |
| 14217 | 1023 |
| 14218 | 1023 |
| 14219 | 1023 |
| 14220 | 1023 |
| 14221 | 1023 |
| 14222 | 1023 |
| 14223 | 1023 |
| 14224 | 1023 |
| 14225 | 1023 |
| 14226 | 1023 |
| 14227 | 1023 |
| 14228 | 1023 |
| 14229 | 1023 |
| 14230 | 1023 |
| 14231 | 1023 |
| 14232 | 1023 |
| 14233 | 1023 |
| 14234 | 1023 |
| 14235 | 1023 |
| 14236 | 1023 |
| 14237 | 1023 |
| 14238 | 1023 |
| 14239 | 1023 |
| 14240 | 1023 |
| 14241 | 1023 |
| 14242 | 1023 |
| 14243 | 1023 |
| 14244 | 1023 |
| 14245 | 1023 |
| 14246 | 1023 |
| 14247 | 1023 |
| 14248 | 1023 |
| 14249 | 1023 |
| 14250 | 1023 |
| 14251 | 1023 |
| 14252 | 1023 |
| 14253 | 1023 |
| 14254 | 1023 |
| 14255 | 0 |
| 14256 | 0 |
| 14257 | 0 |
| 14258 | 0 |
| 14259 | 0 |
| 14260 | 0 |
| 14261 | 0 |
| 14262 | 0 |
| 14263 | 0 |
| 14264 | 0 |
| 14265 | 0 |
| 14266 | 0 |
| 14267 | 0 |
| 14268 | 0 |
| 14269 | 1023 |
| 14270 | 1023 |
| 14271 | 1023 |
| 14272 | 1023 |
| 14273 | 1023 |
| 14274 | 1023 |
| 14275 | 1023 |
| 14276 | 1023 |
| 14277 | 1023 |
| 14278 | 1023 |
| 14279 | 1023 |
| 14280 | 1023 |
| 14281 | 1023 |
| 14282 | 1023 |
| 14283 | 1023 |
| 14284 | 1023 |
| 14285 | 1023 |
| 14286 | 1023 |
| 14287 | 1023 |
| 14288 | 1023 |
| 14289 | 1023 |
| 14290 | 1023 |
| 14291 | 1023 |
| 14292 | 1023 |
| 14293 | 1023 |
| 14294 | 1023 |
| 14295 | 1023 |
| 14296 | 1023 |
| 14297 | 1023 |
| 14298 | 1023 |
| 14299 | 1023 |
| 14300 | 1023 |
| 14301 | 1023 |
| 14302 | 1023 |
| 14303 | 1023 |
| 14304 | 1023 |
| 14305 | 1023 |
| 14306 | 0 |
| 14307 | 0 |
| 14308 | 0 |
| 14309 | 0 |
| 14310 | 0 |
| 14311 | 0 |
| 14312 | 0 |
| 14313 | 0 |
| 14314 | 0 |
| 14315 | 0 |
| 14316 | 0 |
| 14317 | 0 |
| 14318 | 0 |
| 14319 | 0 |
| 14320 | 1023 |
| 14321 | 1023 |
| 14322 | 1023 |
| 14323 | 1023 |
| 14324 | 1023 |
| 14325 | 1023 |
| 14326 | 1023 |
| 14327 | 1023 |
| 14328 | 1023 |
| 14329 | 1023 |
| 14330 | 1023 |
| 14331 | 1023 |
| 14332 | 1023 |
| 14333 | 1023 |
| 14334 | 1023 |
| 14335 | 1023 |
| 14336 | 1023 |
| 14337 | 1023 |
| 14338 | 1023 |
| 14339 | 1023 |
| 14340 | 1023 |
| 14341 | 1023 |
| 14342 | 1023 |
| 14343 | 1023 |
| 14344 | 1023 |
| 14345 | 1023 |
| 14346 | 1023 |
| 14347 | 1023 |
| 14348 | 1023 |
| 14349 | 1023 |
| 14350 | 1023 |
| 14351 | 1023 |
| 14352 | 1023 |
| 14353 | 1023 |
| 14354 | 1023 |
| 14355 | 1023 |
| 14356 | 1023 |
| 14357 | 1023 |
| 14358 | 0 |
| 14359 | 0 |
| 14360 | 0 |
| 14361 | 0 |
| 14362 | 0 |
| 14363 | 0 |
| 14364 | 0 |
| 14365 | 0 |
| 14366 | 0 |
| 14367 | 0 |
| 14368 | 0 |
| 14369 | 0 |
| 14370 | 0 |
| 14371 | 0 |
| 14372 | 1023 |
| 14373 | 1023 |
| 14374 | 1023 |
| 14375 | 1023 |
| 14376 | 1023 |
| 14377 | 1023 |
| 14378 | 1023 |
| 14379 | 1023 |
| 14380 | 1023 |
| 14381 | 1023 |
| 14382 | 1023 |
| 14383 | 1023 |
| 14384 | 1023 |
| 14385 | 1023 |
| 14386 | 1023 |
| 14387 | 1023 |
| 14388 | 1023 |
| 14389 | 1023 |
| 14390 | 1023 |
| 14391 | 1023 |
| 14392 | 1023 |
| 14393 | 1023 |
| 14394 | 1023 |
| 14395 | 1023 |
| 14396 | 1023 |
| 14397 | 1023 |
| 14398 | 1023 |
| 14399 | 1023 |
| 14400 | 1023 |
| 14401 | 1023 |
| 14402 | 1023 |
| 14403 | 1023 |
| 14404 | 1023 |
| 14405 | 1023 |
| 14406 | 1023 |
| 14407 | 1023 |
| 14408 | 1023 |
| 14409 | 0 |
| 14410 | 0 |
| 14411 | 0 |
| 14412 | 0 |
| 14413 | 0 |
| 14414 | 0 |
| 14415 | 0 |
| 14416 | 0 |
| 14417 | 0 |
| 14418 | 0 |
| 14419 | 0 |
| 14420 | 0 |
| 14421 | 0 |
| 14422 | 0 |
| 14423 | 0 |
| 14424 | 1023 |
| 14425 | 1023 |
| 14426 | 1023 |
| 14427 | 1023 |
| 14428 | 1023 |
| 14429 | 1023 |
| 14430 | 1023 |
| 14431 | 1023 |
| 14432 | 1023 |
| 14433 | 1023 |
| 14434 | 1023 |
| 14435 | 1023 |
| 14436 | 1023 |
| 14437 | 1023 |
| 14438 | 1023 |
| 14439 | 1023 |
| 14440 | 1023 |
| 14441 | 1023 |
| 14442 | 1023 |
| 14443 | 1023 |
| 14444 | 1023 |
| 14445 | 1023 |
| 14446 | 1023 |
| 14447 | 1023 |
| 14448 | 1023 |
| 14449 | 1023 |
| 14450 | 1023 |
| 14451 | 1023 |
| 14452 | 1023 |
| 14453 | 1023 |
| 14454 | 1023 |
| 14455 | 1023 |
| 14456 | 1023 |
| 14457 | 1023 |
| 14458 | 1023 |
| 14459 | 1023 |
| 14460 | 1023 |
| 14461 | 0 |
| 14462 | 0 |
| 14463 | 0 |
| 14464 | 0 |
| 14465 | 0 |
| 14466 | 0 |
| 14467 | 0 |
| 14468 | 0 |
| 14469 | 0 |
| 14470 | 0 |
| 14471 | 0 |
| 14472 | 1 |
| 14473 | 1 |
| 14474 | 0 |
| 14475 | 0 |
| 14476 | 1023 |
| 14477 | 1023 |
| 14478 | 1023 |
| 14479 | 1023 |
| 14480 | 1023 |
| 14481 | 1023 |
| 14482 | 1023 |
| 14483 | 1023 |
| 14484 | 1023 |
| 14485 | 1023 |
| 14486 | 1023 |
| 14487 | 1023 |
| 14488 | 1023 |
| 14489 | 1023 |
| 14490 | 1023 |
| 14491 | 1023 |
| 14492 | 1023 |
| 14493 | 1023 |
| 14494 | 1023 |
| 14495 | 1023 |
| 14496 | 1023 |
| 14497 | 1023 |
| 14498 | 1023 |
| 14499 | 1023 |
| 14500 | 1023 |
| 14501 | 1023 |
| 14502 | 1023 |
| 14503 | 1023 |
| 14504 | 1023 |
| 14505 | 1023 |
| 14506 | 1023 |
| 14507 | 1023 |
| 14508 | 1023 |
| 14509 | 1023 |
| 14510 | 1023 |
| 14511 | 1023 |
| 14512 | 1023 |
| 14513 | 1023 |
| 14514 | 0 |
| 14515 | 0 |
| 14516 | 0 |
| 14517 | 0 |
| 14518 | 0 |
| 14519 | 0 |
| 14520 | 0 |
| 14521 | 0 |
| 14522 | 0 |
| 14523 | 0 |
| 14524 | 0 |
| 14525 | 0 |
| 14526 | 0 |
| 14527 | 1023 |
| 14528 | 1023 |
| 14529 | 1023 |
| 14530 | 1023 |
| 14531 | 1023 |
| 14532 | 1023 |
| 14533 | 1023 |
| 14534 | 1023 |
| 14535 | 1023 |
| 14536 | 1023 |
| 14537 | 1023 |
| 14538 | 1023 |
| 14539 | 1023 |
| 14540 | 1023 |
| 14541 | 1023 |
| 14542 | 1023 |
| 14543 | 1023 |
| 14544 | 1023 |
| 14545 | 1023 |
| 14546 | 1023 |
| 14547 | 1023 |
| 14548 | 1023 |
| 14549 | 1023 |
| 14550 | 1023 |
| 14551 | 1023 |
| 14552 | 1023 |
| 14553 | 1023 |
| 14554 | 1023 |
| 14555 | 1023 |
| 14556 | 1023 |
| 14557 | 1023 |
| 14558 | 1023 |
| 14559 | 1023 |
| 14560 | 1023 |
| 14561 | 1023 |
| 14562 | 1023 |
| 14563 | 1023 |
| 14564 | 1023 |
| 14565 | 0 |
| 14566 | 0 |
| 14567 | 0 |
| 14568 | 0 |
| 14569 | 0 |
| 14570 | 0 |
| 14571 | 0 |
| 14572 | 0 |
| 14573 | 0 |
| 14574 | 0 |
| 14575 | 0 |
| 14576 | 0 |
| 14577 | 0 |
| 14578 | 1023 |
| 14579 | 1023 |
| 14580 | 1023 |
| 14581 | 1023 |
| 14582 | 1023 |
| 14583 | 1023 |
| 14584 | 1023 |
| 14585 | 1023 |
| 14586 | 1023 |
| 14587 | 1023 |
| 14588 | 1023 |
| 14589 | 1023 |
| 14590 | 1023 |
| 14591 | 1023 |
| 14592 | 1023 |
| 14593 | 1023 |
| 14594 | 1023 |
| 14595 | 1023 |
| 14596 | 1023 |
| 14597 | 1023 |
| 14598 | 1023 |
| 14599 | 1023 |
| 14600 | 1023 |
| 14601 | 1023 |
| 14602 | 1023 |
| 14603 | 1023 |
| 14604 | 1023 |
| 14605 | 1023 |
| 14606 | 1023 |
| 14607 | 1023 |
| 14608 | 1023 |
| 14609 | 1023 |
| 14610 | 1023 |
| 14611 | 1023 |
| 14612 | 1023 |
| 14613 | 1023 |
| 14614 | 1023 |
| 14615 | 1023 |
| 14616 | 0 |
| 14617 | 0 |
| 14618 | 0 |
| 14619 | 0 |
| 14620 | 1 |
| 14621 | 0 |
| 14622 | 0 |
| 14623 | 0 |
| 14624 | 0 |
| 14625 | 0 |
| 14626 | 0 |
| 14627 | 0 |
| 14628 | 0 |
| 14629 | 1023 |
| 14630 | 1023 |
| 14631 | 1023 |
| 14632 | 1023 |
| 14633 | 1023 |
| 14634 | 1023 |
| 14635 | 1023 |
| 14636 | 1023 |
| 14637 | 1023 |
| 14638 | 1023 |
| 14639 | 1023 |
| 14640 | 1023 |
| 14641 | 1023 |
| 14642 | 1023 |
| 14643 | 1023 |
| 14644 | 1023 |
| 14645 | 1023 |
| 14646 | 1023 |
| 14647 | 1023 |
| 14648 | 1023 |
| 14649 | 1023 |
| 14650 | 1023 |
| 14651 | 1023 |
| 14652 | 1023 |
| 14653 | 1023 |
| 14654 | 1023 |
| 14655 | 1023 |
| 14656 | 1023 |
| 14657 | 1023 |
| 14658 | 1023 |
| 14659 | 1023 |
| 14660 | 1023 |
| 14661 | 1023 |
| 14662 | 1023 |
| 14663 | 1023 |
| 14664 | 1023 |
| 14665 | 1023 |
| 14666 | 1023 |
| 14667 | 0 |
| 14668 | 0 |
| 14669 | 0 |
| 14670 | 0 |
| 14671 | 0 |
| 14672 | 0 |
| 14673 | 0 |
| 14674 | 0 |
| 14675 | 0 |
| 14676 | 0 |
| 14677 | 0 |
| 14678 | 0 |
| 14679 | 0 |
| 14680 | 1023 |
| 14681 | 1023 |
| 14682 | 1023 |
| 14683 | 1023 |
| 14684 | 1023 |
| 14685 | 1023 |
| 14686 | 1023 |
| 14687 | 1023 |
| 14688 | 1023 |
| 14689 | 1023 |
| 14690 | 1023 |
| 14691 | 1023 |
| 14692 | 1023 |
| 14693 | 1023 |
| 14694 | 1023 |
| 14695 | 1023 |
| 14696 | 1023 |
| 14697 | 1023 |
| 14698 | 1023 |
| 14699 | 1023 |
| 14700 | 1023 |
| 14701 | 1023 |
| 14702 | 1023 |
| 14703 | 1023 |
| 14704 | 1023 |
| 14705 | 1023 |
| 14706 | 1023 |
| 14707 | 1023 |
| 14708 | 1023 |
| 14709 | 1023 |
| 14710 | 1023 |
| 14711 | 1023 |
| 14712 | 1023 |
| 14713 | 1023 |
| 14714 | 1023 |
| 14715 | 1023 |
| 14716 | 1023 |
| 14717 | 1023 |
| 14718 | 0 |
| 14719 | 0 |
| 14720 | 0 |
| 14721 | 0 |
| 14722 | 0 |
| 14723 | 0 |
| 14724 | 0 |
| 14725 | 0 |
| 14726 | 0 |
| 14727 | 0 |
| 14728 | 0 |
| 14729 | 0 |
| 14730 | 0 |
| 14731 | 1023 |
| 14732 | 1023 |
| 14733 | 1023 |
| 14734 | 1023 |
| 14735 | 1023 |
| 14736 | 1023 |
| 14737 | 1023 |
| 14738 | 1023 |
| 14739 | 1023 |
| 14740 | 1023 |
| 14741 | 1023 |
| 14742 | 1023 |
| 14743 | 1023 |
| 14744 | 1023 |
| 14745 | 1023 |
| 14746 | 1023 |
| 14747 | 1023 |
| 14748 | 1023 |
| 14749 | 1023 |
| 14750 | 1023 |
| 14751 | 1023 |
| 14752 | 1023 |
| 14753 | 1023 |
| 14754 | 1023 |
| 14755 | 1023 |
| 14756 | 1023 |
| 14757 | 1023 |
| 14758 | 1023 |
| 14759 | 1023 |
| 14760 | 1023 |
| 14761 | 1023 |
| 14762 | 1023 |
| 14763 | 1023 |
| 14764 | 1023 |
| 14765 | 1023 |
| 14766 | 1023 |
| 14767 | 1023 |
| 14768 | 1023 |
| 14769 | 0 |
| 14770 | 0 |
| 14771 | 0 |
| 14772 | 0 |
| 14773 | 0 |
| 14774 | 0 |
| 14775 | 0 |
| 14776 | 0 |
| 14777 | 0 |
| 14778 | 0 |
| 14779 | 0 |
| 14780 | 0 |
| 14781 | 0 |
| 14782 | 0 |
| 14783 | 1023 |
| 14784 | 1023 |
| 14785 | 1023 |
| 14786 | 1023 |
| 14787 | 1023 |
| 14788 | 1023 |
| 14789 | 1023 |
| 14790 | 1023 |
| 14791 | 1023 |
| 14792 | 1023 |
| 14793 | 1023 |
| 14794 | 1023 |
| 14795 | 1023 |
| 14796 | 1023 |
| 14797 | 1023 |
| 14798 | 1023 |
| 14799 | 1023 |
| 14800 | 1023 |
| 14801 | 1023 |
| 14802 | 1023 |
| 14803 | 1023 |
| 14804 | 1023 |
| 14805 | 1023 |
| 14806 | 1023 |
| 14807 | 1023 |
| 14808 | 1023 |
| 14809 | 1023 |
| 14810 | 1023 |
| 14811 | 1023 |
| 14812 | 1023 |
| 14813 | 1023 |
| 14814 | 1023 |
| 14815 | 1023 |
| 14816 | 1023 |
| 14817 | 1023 |
| 14818 | 1023 |
| 14819 | 1023 |
| 14820 | 0 |
| 14821 | 0 |
| 14822 | 0 |
| 14823 | 0 |
| 14824 | 0 |
| 14825 | 0 |
| 14826 | 0 |
| 14827 | 0 |
| 14828 | 0 |
| 14829 | 0 |
| 14830 | 0 |
| 14831 | 0 |
| 14832 | 0 |
| 14833 | 0 |
| 14834 | 1023 |
| 14835 | 1023 |
| 14836 | 1023 |
| 14837 | 1023 |
| 14838 | 1023 |
| 14839 | 1023 |
| 14840 | 1023 |
| 14841 | 1023 |
| 14842 | 1023 |
| 14843 | 1023 |
| 14844 | 1023 |
| 14845 | 1023 |
| 14846 | 1023 |
| 14847 | 1023 |
| 14848 | 1023 |
| 14849 | 1023 |
| 14850 | 1023 |
| 14851 | 1023 |
| 14852 | 1023 |
| 14853 | 1023 |
| 14854 | 1023 |
| 14855 | 1023 |
| 14856 | 1023 |
| 14857 | 1023 |
| 14858 | 1023 |
| 14859 | 1023 |
| 14860 | 1023 |
| 14861 | 1023 |
| 14862 | 1023 |
| 14863 | 1023 |
| 14864 | 1023 |
| 14865 | 1023 |
| 14866 | 1023 |
| 14867 | 1023 |
| 14868 | 1023 |
| 14869 | 1023 |
| 14870 | 1023 |
| 14871 | 1023 |
| 14872 | 0 |
| 14873 | 0 |
| 14874 | 0 |
| 14875 | 0 |
| 14876 | 0 |
| 14877 | 0 |
| 14878 | 0 |
| 14879 | 0 |
| 14880 | 0 |
| 14881 | 0 |
| 14882 | 0 |
| 14883 | 0 |
| 14884 | 0 |
| 14885 | 0 |
| 14886 | 1023 |
| 14887 | 1023 |
| 14888 | 1023 |
| 14889 | 1023 |
| 14890 | 1023 |
| 14891 | 1023 |
| 14892 | 1023 |
| 14893 | 1023 |
| 14894 | 1023 |
| 14895 | 1023 |
| 14896 | 1023 |
| 14897 | 1023 |
| 14898 | 1023 |
| 14899 | 1023 |
| 14900 | 1023 |
| 14901 | 1023 |
| 14902 | 1023 |
| 14903 | 1023 |
| 14904 | 1023 |
| 14905 | 1023 |
| 14906 | 1023 |
| 14907 | 1023 |
| 14908 | 1023 |
| 14909 | 1023 |
| 14910 | 1023 |
| 14911 | 1023 |
| 14912 | 1023 |
| 14913 | 1023 |
| 14914 | 1023 |
| 14915 | 1023 |
| 14916 | 1023 |
| 14917 | 1023 |
| 14918 | 1023 |
| 14919 | 1023 |
| 14920 | 1023 |
| 14921 | 1023 |
| 14922 | 1023 |
| 14923 | 0 |
| 14924 | 0 |
| 14925 | 0 |
| 14926 | 0 |
| 14927 | 0 |
| 14928 | 0 |
| 14929 | 0 |
| 14930 | 0 |
| 14931 | 0 |
| 14932 | 0 |
| 14933 | 0 |
| 14934 | 0 |
| 14935 | 0 |
| 14936 | 0 |
| 14937 | 1023 |
| 14938 | 1023 |
| 14939 | 1023 |
| 14940 | 1023 |
| 14941 | 1023 |
| 14942 | 1023 |
| 14943 | 1023 |
| 14944 | 1023 |
| 14945 | 1023 |
| 14946 | 1023 |
| 14947 | 1023 |
| 14948 | 1023 |
| 14949 | 1023 |
| 14950 | 1023 |
| 14951 | 1023 |
| 14952 | 1023 |
| 14953 | 1023 |
| 14954 | 1023 |
| 14955 | 1023 |
| 14956 | 1023 |
| 14957 | 1023 |
| 14958 | 1023 |
| 14959 | 1023 |
| 14960 | 1023 |
| 14961 | 1023 |
| 14962 | 1023 |
| 14963 | 1023 |
| 14964 | 1023 |
| 14965 | 1023 |
| 14966 | 1023 |
| 14967 | 1023 |
| 14968 | 1023 |
| 14969 | 1023 |
| 14970 | 1023 |
| 14971 | 1023 |
| 14972 | 1023 |
| 14973 | 1023 |
| 14974 | 1023 |
| 14975 | 0 |
| 14976 | 0 |
| 14977 | 0 |
| 14978 | 0 |
| 14979 | 0 |
| 14980 | 0 |
| 14981 | 0 |
| 14982 | 0 |
| 14983 | 0 |
| 14984 | 0 |
| 14985 | 0 |
| 14986 | 0 |
| 14987 | 0 |
| 14988 | 0 |
| 14989 | 1023 |
| 14990 | 1023 |
| 14991 | 1023 |
| 14992 | 1023 |
| 14993 | 1023 |
| 14994 | 1023 |
| 14995 | 1023 |
| 14996 | 1023 |
| 14997 | 1023 |
| 14998 | 1023 |
| 14999 | 1023 |
| 15000 | 1023 |
| 15001 | 1023 |
| 15002 | 1023 |
| 15003 | 1023 |
| 15004 | 1023 |
| 15005 | 1023 |
| 15006 | 1023 |
| 15007 | 1023 |
| 15008 | 1023 |
| 15009 | 1023 |
| 15010 | 1023 |
| 15011 | 1023 |
| 15012 | 1023 |
| 15013 | 1023 |
| 15014 | 1023 |
| 15015 | 1023 |
| 15016 | 1023 |
| 15017 | 1023 |
| 15018 | 1023 |
| 15019 | 1023 |
| 15020 | 1023 |
| 15021 | 1023 |
| 15022 | 1023 |
| 15023 | 1023 |
| 15024 | 1023 |
| 15025 | 1023 |
| 15026 | 1 |
| 15027 | 0 |
| 15028 | 1 |
| 15029 | 0 |
| 15030 | 0 |
| 15031 | 0 |
| 15032 | 0 |
| 15033 | 0 |
| 15034 | 0 |
| 15035 | 0 |
| 15036 | 0 |
| 15037 | 0 |
| 15038 | 0 |
| 15039 | 0 |
| 15040 | 0 |
| 15041 | 1023 |
| 15042 | 1023 |
| 15043 | 1023 |
| 15044 | 1023 |
| 15045 | 1023 |
| 15046 | 1023 |
| 15047 | 1023 |
| 15048 | 1023 |
| 15049 | 1023 |
| 15050 | 1023 |
| 15051 | 1023 |
| 15052 | 1023 |
| 15053 | 1023 |
| 15054 | 1023 |
| 15055 | 1023 |
| 15056 | 1023 |
| 15057 | 1023 |
| 15058 | 1023 |
| 15059 | 1023 |
| 15060 | 1023 |
| 15061 | 1023 |
| 15062 | 1023 |
| 15063 | 1023 |
| 15064 | 1023 |
| 15065 | 1023 |
| 15066 | 1023 |
| 15067 | 1023 |
| 15068 | 1023 |
| 15069 | 1023 |
| 15070 | 1023 |
| 15071 | 1023 |
| 15072 | 1023 |
| 15073 | 1023 |
| 15074 | 1023 |
| 15075 | 1023 |
| 15076 | 1023 |
| 15077 | 1023 |
| 15078 | 32 |
| 15079 | 0 |
| 15080 | 0 |
| 15081 | 0 |
| 15082 | 0 |
| 15083 | 0 |
| 15084 | 0 |
| 15085 | 0 |
| 15086 | 0 |
| 15087 | 0 |
| 15088 | 0 |
| 15089 | 0 |
| 15090 | 0 |
| 15091 | 0 |
| 15092 | 0 |
| 15093 | 1023 |
| 15094 | 1023 |
| 15095 | 1023 |
| 15096 | 1023 |
| 15097 | 1023 |
| 15098 | 1023 |
| 15099 | 1023 |
| 15100 | 1023 |
| 15101 | 1023 |
| 15102 | 1023 |
| 15103 | 1023 |
| 15104 | 1023 |
| 15105 | 1023 |
| 15106 | 1023 |
| 15107 | 1023 |
| 15108 | 1023 |
| 15109 | 1023 |
| 15110 | 1023 |
| 15111 | 1023 |
| 15112 | 1023 |
| 15113 | 1023 |
| 15114 | 1023 |
| 15115 | 1023 |
| 15116 | 1023 |
| 15117 | 1023 |
| 15118 | 1023 |
| 15119 | 1023 |
| 15120 | 1023 |
| 15121 | 1023 |
| 15122 | 1023 |
| 15123 | 1023 |
| 15124 | 1023 |
| 15125 | 1023 |
| 15126 | 1023 |
| 15127 | 1023 |
| 15128 | 1023 |
| 15129 | 1023 |
| 15130 | 0 |
| 15131 | 0 |
| 15132 | 0 |
| 15133 | 0 |
| 15134 | 0 |
| 15135 | 0 |
| 15136 | 0 |
| 15137 | 0 |
| 15138 | 0 |
| 15139 | 0 |
| 15140 | 0 |
| 15141 | 0 |
| 15142 | 0 |
| 15143 | 0 |
| 15144 | 0 |
| 15145 | 1023 |
| 15146 | 1023 |
| 15147 | 1023 |
| 15148 | 1023 |
| 15149 | 1023 |
| 15150 | 1023 |
| 15151 | 1023 |
| 15152 | 1023 |
| 15153 | 1023 |
| 15154 | 1023 |
| 15155 | 1023 |
| 15156 | 1023 |
| 15157 | 1023 |
| 15158 | 1023 |
| 15159 | 1023 |
| 15160 | 1023 |
| 15161 | 1023 |
| 15162 | 1023 |
| 15163 | 1023 |
| 15164 | 1023 |
| 15165 | 1023 |
| 15166 | 1023 |
| 15167 | 1023 |
| 15168 | 1023 |
| 15169 | 1023 |
| 15170 | 1023 |
| 15171 | 1023 |
| 15172 | 1023 |
| 15173 | 1023 |
| 15174 | 1023 |
| 15175 | 1023 |
| 15176 | 1023 |
| 15177 | 1023 |
| 15178 | 1023 |
| 15179 | 1023 |
| 15180 | 1023 |
| 15181 | 1023 |
| 15182 | 0 |
| 15183 | 0 |
| 15184 | 0 |
| 15185 | 0 |
| 15186 | 0 |
| 15187 | 0 |
| 15188 | 0 |
| 15189 | 0 |
| 15190 | 0 |
| 15191 | 0 |
| 15192 | 0 |
| 15193 | 0 |
| 15194 | 0 |
| 15195 | 0 |
| 15196 | 0 |
| 15197 | 1023 |
| 15198 | 1023 |
| 15199 | 1023 |
| 15200 | 1023 |
| 15201 | 1023 |
| 15202 | 1023 |
| 15203 | 1023 |
| 15204 | 1023 |
| 15205 | 1023 |
| 15206 | 1023 |
| 15207 | 1023 |
| 15208 | 1023 |
| 15209 | 1023 |
| 15210 | 1023 |
| 15211 | 1023 |
| 15212 | 1023 |
| 15213 | 1023 |
| 15214 | 1023 |
| 15215 | 1023 |
| 15216 | 1023 |
| 15217 | 1023 |
| 15218 | 1023 |
| 15219 | 1023 |
| 15220 | 1023 |
| 15221 | 1023 |
| 15222 | 1023 |
| 15223 | 1023 |
| 15224 | 1023 |
| 15225 | 1023 |
| 15226 | 1023 |
| 15227 | 1023 |
| 15228 | 1023 |
| 15229 | 1023 |
| 15230 | 1023 |
| 15231 | 1023 |
| 15232 | 1023 |
| 15233 | 1023 |
| 15234 | 0 |
| 15235 | 0 |
| 15236 | 0 |
| 15237 | 0 |
| 15238 | 0 |
| 15239 | 0 |
| 15240 | 0 |
| 15241 | 0 |
| 15242 | 0 |
| 15243 | 0 |
| 15244 | 0 |
| 15245 | 0 |
| 15246 | 0 |
| 15247 | 0 |
| 15248 | 0 |
| 15249 | 1023 |
| 15250 | 1023 |
| 15251 | 1023 |
| 15252 | 1023 |
| 15253 | 1023 |
| 15254 | 1023 |
| 15255 | 1023 |
| 15256 | 1023 |
| 15257 | 1023 |
| 15258 | 1023 |
| 15259 | 1023 |
| 15260 | 1023 |
| 15261 | 1023 |
| 15262 | 1023 |
| 15263 | 1023 |
| 15264 | 1023 |
| 15265 | 1023 |
| 15266 | 1023 |
| 15267 | 1023 |
| 15268 | 1023 |
| 15269 | 1023 |
| 15270 | 1023 |
| 15271 | 1023 |
| 15272 | 1023 |
| 15273 | 1023 |
| 15274 | 1023 |
| 15275 | 1023 |
| 15276 | 1023 |
| 15277 | 1023 |
| 15278 | 1023 |
| 15279 | 1023 |
| 15280 | 1023 |
| 15281 | 1023 |
| 15282 | 1023 |
| 15283 | 1023 |
| 15284 | 1023 |
| 15285 | 1023 |
| 15286 | 1023 |
| 15287 | 0 |
| 15288 | 0 |
| 15289 | 0 |
| 15290 | 0 |
| 15291 | 0 |
| 15292 | 0 |
| 15293 | 0 |
| 15294 | 0 |
| 15295 | 0 |
| 15296 | 0 |
| 15297 | 0 |
| 15298 | 0 |
| 15299 | 0 |
| 15300 | 1023 |
| 15301 | 1023 |
| 15302 | 1023 |
| 15303 | 1023 |
| 15304 | 1023 |
| 15305 | 1023 |
| 15306 | 1023 |
| 15307 | 1023 |
| 15308 | 1023 |
| 15309 | 1023 |
| 15310 | 1023 |
| 15311 | 1023 |
| 15312 | 1023 |
| 15313 | 1023 |
| 15314 | 1023 |
| 15315 | 1023 |
| 15316 | 1023 |
| 15317 | 1023 |
| 15318 | 1023 |
| 15319 | 1023 |
| 15320 | 1023 |
| 15321 | 1023 |
| 15322 | 1023 |
| 15323 | 1023 |
| 15324 | 1023 |
| 15325 | 1023 |
| 15326 | 1023 |
| 15327 | 1023 |
| 15328 | 1023 |
| 15329 | 1023 |
| 15330 | 1023 |
| 15331 | 1023 |
| 15332 | 1023 |
| 15333 | 1023 |
| 15334 | 1023 |
| 15335 | 1023 |
| 15336 | 1023 |
| 15337 | 1023 |
| 15338 | 0 |
| 15339 | 0 |
| 15340 | 0 |
| 15341 | 0 |
| 15342 | 0 |
| 15343 | 0 |
| 15344 | 0 |
| 15345 | 0 |
| 15346 | 0 |
| 15347 | 0 |
| 15348 | 0 |
| 15349 | 0 |
| 15350 | 0 |
| 15351 | 1023 |
| 15352 | 1023 |
| 15353 | 1023 |
| 15354 | 1023 |
| 15355 | 1023 |
| 15356 | 1023 |
| 15357 | 1023 |
| 15358 | 1023 |
| 15359 | 1023 |
| 15360 | 1023 |
| 15361 | 1023 |
| 15362 | 1023 |
| 15363 | 1023 |
| 15364 | 1023 |
| 15365 | 1023 |
| 15366 | 1023 |
| 15367 | 1023 |
| 15368 | 1023 |
| 15369 | 1023 |
| 15370 | 1023 |
| 15371 | 1023 |
| 15372 | 1023 |
| 15373 | 1023 |
| 15374 | 1023 |
| 15375 | 1023 |
| 15376 | 1023 |
| 15377 | 1023 |
| 15378 | 1023 |
| 15379 | 1023 |
| 15380 | 1023 |
| 15381 | 1023 |
| 15382 | 1023 |
| 15383 | 1023 |
| 15384 | 1023 |
| 15385 | 1023 |
| 15386 | 1023 |
| 15387 | 1023 |
| 15388 | 1023 |
| 15389 | 0 |
| 15390 | 0 |
| 15391 | 0 |
| 15392 | 0 |
| 15393 | 0 |
| 15394 | 0 |
| 15395 | 0 |
| 15396 | 0 |
| 15397 | 0 |
| 15398 | 0 |
| 15399 | 0 |
| 15400 | 0 |
| 15401 | 1 |
| 15402 | 1023 |
| 15403 | 1023 |
| 15404 | 1023 |
| 15405 | 1023 |
| 15406 | 1023 |
| 15407 | 1023 |
| 15408 | 1023 |
| 15409 | 1023 |
| 15410 | 1023 |
| 15411 | 1023 |
| 15412 | 1023 |
| 15413 | 1023 |
| 15414 | 1023 |
| 15415 | 1023 |
| 15416 | 1023 |
| 15417 | 1023 |
| 15418 | 1023 |
| 15419 | 1023 |
| 15420 | 1023 |
| 15421 | 1023 |
| 15422 | 1023 |
| 15423 | 1023 |
| 15424 | 1023 |
| 15425 | 1023 |
| 15426 | 1023 |
| 15427 | 1023 |
| 15428 | 1023 |
| 15429 | 1023 |
| 15430 | 1023 |
| 15431 | 1023 |
| 15432 | 1023 |
| 15433 | 1023 |
| 15434 | 1023 |
| 15435 | 1023 |
| 15436 | 1023 |
| 15437 | 1023 |
| 15438 | 1023 |
| 15439 | 1023 |
| 15440 | 0 |
| 15441 | 0 |
| 15442 | 0 |
| 15443 | 0 |
| 15444 | 0 |
| 15445 | 0 |
| 15446 | 0 |
| 15447 | 0 |
| 15448 | 0 |
| 15449 | 0 |
| 15450 | 0 |
| 15451 | 0 |
| 15452 | 0 |
| 15453 | 1023 |
| 15454 | 1023 |
| 15455 | 1023 |
| 15456 | 1023 |
| 15457 | 1023 |
| 15458 | 1023 |
| 15459 | 1023 |
| 15460 | 1023 |
| 15461 | 1023 |
| 15462 | 1023 |
| 15463 | 1023 |
| 15464 | 1023 |
| 15465 | 1023 |
| 15466 | 1023 |
| 15467 | 1023 |
| 15468 | 1023 |
| 15469 | 1023 |
| 15470 | 1023 |
| 15471 | 1023 |
| 15472 | 1023 |
| 15473 | 1023 |
| 15474 | 1023 |
| 15475 | 1023 |
| 15476 | 1023 |
| 15477 | 1023 |
| 15478 | 1023 |
| 15479 | 1023 |
| 15480 | 1023 |
| 15481 | 1023 |
| 15482 | 1023 |
| 15483 | 1023 |
| 15484 | 1023 |
| 15485 | 1023 |
| 15486 | 1023 |
| 15487 | 1023 |
| 15488 | 1023 |
| 15489 | 1023 |
| 15490 | 1023 |
| 15491 | 0 |
| 15492 | 0 |
| 15493 | 0 |
| 15494 | 0 |
| 15495 | 0 |
| 15496 | 0 |
| 15497 | 0 |
| 15498 | 0 |
| 15499 | 0 |
| 15500 | 0 |
| 15501 | 0 |
| 15502 | 0 |
| 15503 | 0 |
| 15504 | 1023 |
| 15505 | 1023 |
| 15506 | 1023 |
| 15507 | 1023 |
| 15508 | 1023 |
| 15509 | 1023 |
| 15510 | 1023 |
| 15511 | 1023 |
| 15512 | 1023 |
| 15513 | 1023 |
| 15514 | 1023 |
| 15515 | 1023 |
| 15516 | 1023 |
| 15517 | 1023 |
| 15518 | 1023 |
| 15519 | 1023 |
| 15520 | 1023 |
| 15521 | 1023 |
| 15522 | 1023 |
| 15523 | 1023 |
| 15524 | 1023 |
| 15525 | 1023 |
| 15526 | 1023 |
| 15527 | 1023 |
| 15528 | 1023 |
| 15529 | 1023 |
| 15530 | 1023 |
| 15531 | 1023 |
| 15532 | 1023 |
| 15533 | 1023 |
| 15534 | 1023 |
| 15535 | 1023 |
| 15536 | 1023 |
| 15537 | 1023 |
| 15538 | 1023 |
| 15539 | 1023 |
| 15540 | 1023 |
| 15541 | 1023 |
| 15542 | 0 |
| 15543 | 0 |
| 15544 | 0 |
| 15545 | 0 |
| 15546 | 0 |
| 15547 | 0 |
| 15548 | 0 |
| 15549 | 0 |
| 15550 | 0 |
| 15551 | 0 |
| 15552 | 0 |
| 15553 | 0 |
| 15554 | 0 |
| 15555 | 1023 |
| 15556 | 1023 |
| 15557 | 1023 |
| 15558 | 1023 |
| 15559 | 1023 |
| 15560 | 1023 |
| 15561 | 1023 |
| 15562 | 1023 |
| 15563 | 1023 |
| 15564 | 1023 |
| 15565 | 1023 |
| 15566 | 1023 |
| 15567 | 1023 |
| 15568 | 1023 |
| 15569 | 1023 |
| 15570 | 1023 |
| 15571 | 1023 |
| 15572 | 1023 |
| 15573 | 1023 |
| 15574 | 1023 |
| 15575 | 1023 |
| 15576 | 1023 |
| 15577 | 1023 |
| 15578 | 1023 |
| 15579 | 1023 |
| 15580 | 1023 |
| 15581 | 1023 |
| 15582 | 1023 |
| 15583 | 1023 |
| 15584 | 1023 |
| 15585 | 1023 |
| 15586 | 1023 |
| 15587 | 1023 |
| 15588 | 1023 |
| 15589 | 1023 |
| 15590 | 1023 |
| 15591 | 1023 |
| 15592 | 1023 |
| 15593 | 0 |
| 15594 | 0 |
| 15595 | 0 |
| 15596 | 0 |
| 15597 | 0 |
| 15598 | 1 |
| 15599 | 0 |
| 15600 | 0 |
| 15601 | 0 |
| 15602 | 0 |
| 15603 | 0 |
| 15604 | 0 |
| 15605 | 0 |
| 15606 | 1023 |
| 15607 | 1023 |
| 15608 | 1023 |
| 15609 | 1023 |
| 15610 | 1023 |
| 15611 | 1023 |
| 15612 | 1023 |
| 15613 | 1023 |
| 15614 | 1023 |
| 15615 | 1023 |
| 15616 | 1023 |
| 15617 | 1023 |
| 15618 | 1023 |
| 15619 | 1023 |
| 15620 | 1023 |
| 15621 | 1023 |
| 15622 | 1023 |
| 15623 | 1023 |
| 15624 | 1023 |
| 15625 | 1023 |
| 15626 | 1023 |
| 15627 | 1023 |
| 15628 | 1023 |
| 15629 | 1023 |
| 15630 | 1023 |
| 15631 | 1023 |
| 15632 | 1023 |
| 15633 | 1023 |
| 15634 | 1023 |
| 15635 | 1023 |
| 15636 | 1023 |
| 15637 | 1023 |
| 15638 | 1023 |
| 15639 | 1023 |
| 15640 | 1023 |
| 15641 | 1023 |
| 15642 | 1023 |
| 15643 | 1023 |
| 15644 | 0 |
| 15645 | 0 |
| 15646 | 0 |
| 15647 | 0 |
| 15648 | 0 |
| 15649 | 0 |
| 15650 | 0 |
| 15651 | 0 |
| 15652 | 0 |
| 15653 | 0 |
| 15654 | 0 |
| 15655 | 0 |
| 15656 | 0 |
| 15657 | 0 |
| 15658 | 1023 |
| 15659 | 1023 |
| 15660 | 1023 |
| 15661 | 1023 |
| 15662 | 1023 |
| 15663 | 1023 |
| 15664 | 1023 |
| 15665 | 1023 |
| 15666 | 1023 |
| 15667 | 1023 |
| 15668 | 1023 |
| 15669 | 1023 |
| 15670 | 1023 |
| 15671 | 1023 |
| 15672 | 1023 |
| 15673 | 1023 |
| 15674 | 1023 |
| 15675 | 1023 |
| 15676 | 1023 |
| 15677 | 1023 |
| 15678 | 1023 |
| 15679 | 1023 |
| 15680 | 1023 |
| 15681 | 1023 |
| 15682 | 1023 |
| 15683 | 1023 |
| 15684 | 1023 |
| 15685 | 1023 |
| 15686 | 1023 |
| 15687 | 1023 |
| 15688 | 1023 |
| 15689 | 1023 |
| 15690 | 1023 |
| 15691 | 1023 |
| 15692 | 1023 |
| 15693 | 1023 |
| 15694 | 1023 |
| 15695 | 0 |
| 15696 | 0 |
| 15697 | 0 |
| 15698 | 0 |
| 15699 | 0 |
| 15700 | 0 |
| 15701 | 0 |
| 15702 | 0 |
| 15703 | 0 |
| 15704 | 0 |
| 15705 | 0 |
| 15706 | 0 |
| 15707 | 0 |
| 15708 | 0 |
| 15709 | 1023 |
| 15710 | 1023 |
| 15711 | 1023 |
| 15712 | 1023 |
| 15713 | 1023 |
| 15714 | 1023 |
| 15715 | 1023 |
| 15716 | 1023 |
| 15717 | 1023 |
| 15718 | 1023 |
| 15719 | 1023 |
| 15720 | 1023 |
| 15721 | 1023 |
| 15722 | 1023 |
| 15723 | 1023 |
| 15724 | 1023 |
| 15725 | 1023 |
| 15726 | 1023 |
| 15727 | 1023 |
| 15728 | 1023 |
| 15729 | 1023 |
| 15730 | 1023 |
| 15731 | 1023 |
| 15732 | 1023 |
| 15733 | 1023 |
| 15734 | 1023 |
| 15735 | 1023 |
| 15736 | 1023 |
| 15737 | 1023 |
| 15738 | 1023 |
| 15739 | 1023 |
| 15740 | 1023 |
| 15741 | 1023 |
| 15742 | 1023 |
| 15743 | 1023 |
| 15744 | 1023 |
| 15745 | 1023 |
| 15746 | 1023 |
| 15747 | 0 |
| 15748 | 0 |
| 15749 | 0 |
| 15750 | 0 |
| 15751 | 0 |
| 15752 | 0 |
| 15753 | 0 |
| 15754 | 0 |
| 15755 | 0 |
| 15756 | 0 |
| 15757 | 0 |
| 15758 | 0 |
| 15759 | 0 |
| 15760 | 0 |
| 15761 | 1023 |
| 15762 | 1023 |
| 15763 | 1023 |
| 15764 | 1023 |
| 15765 | 1023 |
| 15766 | 1023 |
| 15767 | 1023 |
| 15768 | 1023 |
| 15769 | 1023 |
| 15770 | 1023 |
| 15771 | 1023 |
| 15772 | 1023 |
| 15773 | 1023 |
| 15774 | 1023 |
| 15775 | 1023 |
| 15776 | 1023 |
| 15777 | 1023 |
| 15778 | 1023 |
| 15779 | 1023 |
| 15780 | 1023 |
| 15781 | 1023 |
| 15782 | 1023 |
| 15783 | 1023 |
| 15784 | 1023 |
| 15785 | 1023 |
| 15786 | 1023 |
| 15787 | 1023 |
| 15788 | 1023 |
| 15789 | 1023 |
| 15790 | 1023 |
| 15791 | 1023 |
| 15792 | 1023 |
| 15793 | 1023 |
| 15794 | 1023 |
| 15795 | 1023 |
| 15796 | 1023 |
| 15797 | 1023 |
| 15798 | 0 |
| 15799 | 0 |
| 15800 | 0 |
| 15801 | 0 |
| 15802 | 0 |
| 15803 | 0 |
| 15804 | 0 |
| 15805 | 0 |
| 15806 | 0 |
| 15807 | 0 |
| 15808 | 0 |
| 15809 | 0 |
| 15810 | 0 |
| 15811 | 0 |
| 15812 | 0 |
| 15813 | 1023 |
| 15814 | 1023 |
| 15815 | 1023 |
| 15816 | 1023 |
| 15817 | 1023 |
| 15818 | 1023 |
| 15819 | 1023 |
| 15820 | 1023 |
| 15821 | 1023 |
| 15822 | 1023 |
| 15823 | 1023 |
| 15824 | 1023 |
| 15825 | 1023 |
| 15826 | 1023 |
| 15827 | 1023 |
| 15828 | 1023 |
| 15829 | 1023 |
| 15830 | 1023 |
| 15831 | 1023 |
| 15832 | 1023 |
| 15833 | 1023 |
| 15834 | 1023 |
| 15835 | 1023 |
| 15836 | 1023 |
| 15837 | 1023 |
| 15838 | 1023 |
| 15839 | 1023 |
| 15840 | 1023 |
| 15841 | 1023 |
| 15842 | 1023 |
| 15843 | 1023 |
| 15844 | 1023 |
| 15845 | 1023 |
| 15846 | 1023 |
| 15847 | 1023 |
| 15848 | 1023 |
| 15849 | 1023 |
| 15850 | 0 |
| 15851 | 0 |
| 15852 | 0 |
| 15853 | 0 |
| 15854 | 0 |
| 15855 | 0 |
| 15856 | 0 |
| 15857 | 0 |
| 15858 | 0 |
| 15859 | 0 |
| 15860 | 0 |
| 15861 | 0 |
| 15862 | 0 |
| 15863 | 0 |
| 15864 | 0 |
| 15865 | 1023 |
| 15866 | 1023 |
| 15867 | 1023 |
| 15868 | 1023 |
| 15869 | 1023 |
| 15870 | 1023 |
| 15871 | 1023 |
| 15872 | 1023 |
| 15873 | 1023 |
| 15874 | 1023 |
| 15875 | 1023 |
| 15876 | 1023 |
| 15877 | 1023 |
| 15878 | 1023 |
| 15879 | 1023 |
| 15880 | 1023 |
| 15881 | 1023 |
| 15882 | 1023 |
| 15883 | 1023 |
| 15884 | 1023 |
| 15885 | 1023 |
| 15886 | 1023 |
| 15887 | 1023 |
| 15888 | 1023 |
| 15889 | 1023 |
| 15890 | 1023 |
| 15891 | 1023 |
| 15892 | 1023 |
| 15893 | 1023 |
| 15894 | 1023 |
| 15895 | 1023 |
| 15896 | 1023 |
| 15897 | 1023 |
| 15898 | 1023 |
| 15899 | 1023 |
| 15900 | 1023 |
| 15901 | 1023 |
| 15902 | 1023 |
| 15903 | 0 |
| 15904 | 0 |
| 15905 | 0 |
| 15906 | 0 |
| 15907 | 0 |
| 15908 | 0 |
| 15909 | 0 |
| 15910 | 0 |
| 15911 | 0 |
| 15912 | 0 |
| 15913 | 0 |
| 15914 | 0 |
| 15915 | 0 |
| 15916 | 1023 |
| 15917 | 1023 |
| 15918 | 1023 |
| 15919 | 1023 |
| 15920 | 1023 |
| 15921 | 1023 |
| 15922 | 1023 |
| 15923 | 1023 |
| 15924 | 1023 |
| 15925 | 1023 |
| 15926 | 1023 |
| 15927 | 1023 |
| 15928 | 1023 |
| 15929 | 1023 |
| 15930 | 1023 |
| 15931 | 1023 |
| 15932 | 1023 |
| 15933 | 1023 |
| 15934 | 1023 |
| 15935 | 1023 |
| 15936 | 1023 |
| 15937 | 1023 |
| 15938 | 1023 |
| 15939 | 1023 |
| 15940 | 1023 |
| 15941 | 1023 |
| 15942 | 1023 |
| 15943 | 1023 |
| 15944 | 1023 |
| 15945 | 1023 |
| 15946 | 1023 |
| 15947 | 1023 |
| 15948 | 1023 |
| 15949 | 1023 |
| 15950 | 1023 |
| 15951 | 1023 |
| 15952 | 1023 |
| 15953 | 1023 |
| 15954 | 0 |
| 15955 | 0 |
| 15956 | 0 |
| 15957 | 0 |
| 15958 | 0 |
| 15959 | 0 |
| 15960 | 0 |
| 15961 | 0 |
| 15962 | 0 |
| 15963 | 0 |
| 15964 | 0 |
| 15965 | 0 |
| 15966 | 0 |
| 15967 | 1023 |
| 15968 | 1023 |
| 15969 | 1023 |
| 15970 | 1023 |
| 15971 | 1023 |
| 15972 | 1023 |
| 15973 | 1023 |
| 15974 | 1023 |
| 15975 | 1023 |
| 15976 | 1023 |
| 15977 | 1023 |
| 15978 | 1023 |
| 15979 | 1023 |
| 15980 | 1023 |
| 15981 | 1023 |
| 15982 | 1023 |
| 15983 | 1023 |
| 15984 | 1023 |
| 15985 | 1023 |
| 15986 | 1023 |
| 15987 | 1023 |
| 15988 | 1023 |
| 15989 | 1023 |
| 15990 | 1023 |
| 15991 | 1023 |
| 15992 | 1023 |
| 15993 | 1023 |
| 15994 | 1023 |
| 15995 | 1023 |
| 15996 | 1023 |
| 15997 | 1023 |
| 15998 | 1023 |
| 15999 | 1023 |
| 16000 | 1023 |
| 16001 | 1023 |
| 16002 | 1023 |
| 16003 | 1023 |
| 16004 | 1023 |
| 16005 | 0 |
| 16006 | 0 |
| 16007 | 0 |
| 16008 | 0 |
| 16009 | 0 |
| 16010 | 0 |
| 16011 | 0 |
| 16012 | 0 |
| 16013 | 0 |
| 16014 | 0 |
| 16015 | 0 |
| 16016 | 0 |
| 16017 | 0 |
| 16018 | 1023 |
| 16019 | 1023 |
| 16020 | 1023 |
| 16021 | 1023 |
| 16022 | 1023 |
| 16023 | 1023 |
| 16024 | 1023 |
| 16025 | 1023 |
| 16026 | 1023 |
| 16027 | 1023 |
| 16028 | 1023 |
| 16029 | 1023 |
| 16030 | 1023 |
| 16031 | 1023 |
| 16032 | 1023 |
| 16033 | 1023 |
| 16034 | 1023 |
| 16035 | 1023 |
| 16036 | 1023 |
| 16037 | 1023 |
| 16038 | 1023 |
| 16039 | 1023 |
| 16040 | 1023 |
| 16041 | 1023 |
| 16042 | 1023 |
| 16043 | 1023 |
| 16044 | 1023 |
| 16045 | 1023 |
| 16046 | 1023 |
| 16047 | 1023 |
| 16048 | 1023 |
| 16049 | 1023 |
| 16050 | 1023 |
| 16051 | 1023 |
| 16052 | 1023 |
| 16053 | 1023 |
| 16054 | 1023 |
| 16055 | 1023 |
| 16056 | 0 |
| 16057 | 0 |
| 16058 | 0 |
| 16059 | 0 |
| 16060 | 0 |
| 16061 | 0 |
| 16062 | 0 |
| 16063 | 0 |
| 16064 | 0 |
| 16065 | 0 |
| 16066 | 0 |
| 16067 | 0 |
| 16068 | 0 |
| 16069 | 1023 |
| 16070 | 1023 |
| 16071 | 1023 |
| 16072 | 1023 |
| 16073 | 1023 |
| 16074 | 1023 |
| 16075 | 1023 |
| 16076 | 1023 |
| 16077 | 1023 |
| 16078 | 1023 |
| 16079 | 1023 |
| 16080 | 1023 |
| 16081 | 1023 |
| 16082 | 1023 |
| 16083 | 1023 |
| 16084 | 1023 |
| 16085 | 1023 |
| 16086 | 1023 |
| 16087 | 1023 |
| 16088 | 1023 |
| 16089 | 1023 |
| 16090 | 1023 |
| 16091 | 1023 |
| 16092 | 1023 |
| 16093 | 1023 |
| 16094 | 1023 |
| 16095 | 1023 |
| 16096 | 1023 |
| 16097 | 1023 |
| 16098 | 1023 |
| 16099 | 1023 |
| 16100 | 1023 |
| 16101 | 1023 |
| 16102 | 1023 |
| 16103 | 1023 |
| 16104 | 1023 |
| 16105 | 1023 |
| 16106 | 1023 |
| 16107 | 0 |
| 16108 | 0 |
| 16109 | 0 |
| 16110 | 0 |
| 16111 | 0 |
| 16112 | 0 |
| 16113 | 0 |
| 16114 | 0 |
| 16115 | 0 |
| 16116 | 0 |
| 16117 | 0 |
| 16118 | 0 |
| 16119 | 0 |
| 16120 | 1023 |
| 16121 | 1023 |
| 16122 | 1023 |
| 16123 | 1023 |
| 16124 | 1023 |
| 16125 | 1023 |
| 16126 | 1023 |
| 16127 | 1023 |
| 16128 | 1023 |
| 16129 | 1023 |
| 16130 | 1023 |
| 16131 | 1023 |
| 16132 | 1023 |
| 16133 | 1023 |
| 16134 | 1023 |
| 16135 | 1023 |
| 16136 | 1023 |
| 16137 | 1023 |
| 16138 | 1023 |
| 16139 | 1023 |
| 16140 | 1023 |
| 16141 | 1023 |
| 16142 | 1023 |
| 16143 | 1023 |
| 16144 | 1023 |
| 16145 | 1023 |
| 16146 | 1023 |
| 16147 | 1023 |
| 16148 | 1023 |
| 16149 | 1023 |
| 16150 | 1023 |
| 16151 | 1023 |
| 16152 | 1023 |
| 16153 | 1023 |
| 16154 | 1023 |
| 16155 | 1023 |
| 16156 | 1023 |
| 16157 | 1023 |
| 16158 | 0 |
| 16159 | 0 |
| 16160 | 0 |
| 16161 | 0 |
| 16162 | 0 |
| 16163 | 0 |
| 16164 | 0 |
| 16165 | 0 |
| 16166 | 0 |
| 16167 | 0 |
| 16168 | 0 |
| 16169 | 0 |
| 16170 | 0 |
| 16171 | 1023 |
| 16172 | 1023 |
| 16173 | 1023 |
| 16174 | 1023 |
| 16175 | 1023 |
| 16176 | 1023 |
| 16177 | 1023 |
| 16178 | 1023 |
| 16179 | 1023 |
| 16180 | 1023 |
| 16181 | 1023 |
| 16182 | 1023 |
| 16183 | 1023 |
| 16184 | 1023 |
| 16185 | 1023 |
| 16186 | 1023 |
| 16187 | 1023 |
| 16188 | 1023 |
| 16189 | 1023 |
| 16190 | 1023 |
| 16191 | 1023 |
| 16192 | 1023 |
| 16193 | 1023 |
| 16194 | 1023 |
| 16195 | 1023 |
| 16196 | 1023 |
| 16197 | 1023 |
| 16198 | 1023 |
| 16199 | 1023 |
| 16200 | 1023 |
| 16201 | 1023 |
| 16202 | 1023 |
| 16203 | 1023 |
| 16204 | 1023 |
| 16205 | 1023 |
| 16206 | 1023 |
| 16207 | 1023 |
| 16208 | 1023 |
| 16209 | 0 |
| 16210 | 0 |
| 16211 | 0 |
| 16212 | 0 |
| 16213 | 0 |
| 16214 | 0 |
| 16215 | 0 |
| 16216 | 0 |
| 16217 | 0 |
| 16218 | 0 |
| 16219 | 0 |
| 16220 | 0 |
| 16221 | 0 |
| 16222 | 1023 |
| 16223 | 1023 |
| 16224 | 1023 |
| 16225 | 1023 |
| 16226 | 1023 |
| 16227 | 1023 |
| 16228 | 1023 |
| 16229 | 1023 |
| 16230 | 1023 |
| 16231 | 1023 |
| 16232 | 1023 |
| 16233 | 1023 |
| 16234 | 1023 |
| 16235 | 1023 |
| 16236 | 1023 |
| 16237 | 1023 |
| 16238 | 1023 |
| 16239 | 1023 |
| 16240 | 1023 |
| 16241 | 1023 |
| 16242 | 1023 |
| 16243 | 1023 |
| 16244 | 1023 |
| 16245 | 1023 |
| 16246 | 1023 |
| 16247 | 1023 |
| 16248 | 1023 |
| 16249 | 1023 |
| 16250 | 1023 |
| 16251 | 1023 |
| 16252 | 1023 |
| 16253 | 1023 |
| 16254 | 1023 |
| 16255 | 1023 |
| 16256 | 1023 |
| 16257 | 1023 |
| 16258 | 1023 |
| 16259 | 1023 |
| 16260 | 0 |
| 16261 | 0 |
| 16262 | 0 |
| 16263 | 0 |
| 16264 | 0 |
| 16265 | 0 |
| 16266 | 0 |
| 16267 | 0 |
| 16268 | 0 |
| 16269 | 0 |
| 16270 | 0 |
| 16271 | 0 |
| 16272 | 0 |
| 16273 | 0 |
| 16274 | 1023 |
| 16275 | 1023 |
| 16276 | 1023 |
| 16277 | 1023 |
| 16278 | 1023 |
| 16279 | 1023 |
| 16280 | 1023 |
| 16281 | 1023 |
| 16282 | 1023 |
| 16283 | 1023 |
| 16284 | 1023 |
| 16285 | 1023 |
| 16286 | 1023 |
| 16287 | 1023 |
| 16288 | 1023 |
| 16289 | 1023 |
| 16290 | 1023 |
| 16291 | 1023 |
| 16292 | 1023 |
| 16293 | 1023 |
| 16294 | 1023 |
| 16295 | 1023 |
| 16296 | 1023 |
| 16297 | 1023 |
| 16298 | 1023 |
| 16299 | 1023 |
| 16300 | 1023 |
| 16301 | 1023 |
| 16302 | 1023 |
| 16303 | 1023 |
| 16304 | 1023 |
| 16305 | 1023 |
| 16306 | 1023 |
| 16307 | 1023 |
| 16308 | 1023 |
| 16309 | 1023 |
| 16310 | 1023 |
| 16311 | 0 |
| 16312 | 0 |
| 16313 | 0 |
| 16314 | 0 |
| 16315 | 0 |
| 16316 | 0 |
| 16317 | 0 |
| 16318 | 0 |
| 16319 | 0 |
| 16320 | 0 |
| 16321 | 0 |
| 16322 | 0 |
| 16323 | 0 |
| 16324 | 0 |
| 16325 | 1023 |
| 16326 | 1023 |
| 16327 | 1023 |
| 16328 | 1023 |
| 16329 | 1023 |
| 16330 | 1023 |
| 16331 | 1023 |
| 16332 | 1023 |
| 16333 | 1023 |
| 16334 | 1023 |
| 16335 | 1023 |
| 16336 | 1023 |
| 16337 | 1023 |
| 16338 | 1023 |
| 16339 | 1023 |
| 16340 | 1023 |
| 16341 | 1023 |
| 16342 | 1023 |
| 16343 | 1023 |
| 16344 | 1023 |
| 16345 | 1023 |
| 16346 | 1023 |
| 16347 | 1023 |
| 16348 | 1023 |
| 16349 | 1023 |
| 16350 | 1023 |
| 16351 | 1023 |
| 16352 | 1023 |
| 16353 | 1023 |
| 16354 | 1023 |
| 16355 | 1023 |
| 16356 | 1023 |
| 16357 | 1023 |
| 16358 | 1023 |
| 16359 | 1023 |
| 16360 | 1023 |
| 16361 | 1023 |
| 16362 | 1023 |
| 16363 | 0 |
| 16364 | 0 |
| 16365 | 0 |
| 16366 | 0 |
| 16367 | 0 |
| 16368 | 0 |
| 16369 | 0 |
| 16370 | 0 |
| 16371 | 0 |
| 16372 | 0 |
| 16373 | 0 |
| 16374 | 0 |
| 16375 | 0 |
| 16376 | 0 |
| 16377 | 1023 |
| 16378 | 1023 |
| 16379 | 1023 |
| 16380 | 1023 |
| 16381 | 1023 |
| 16382 | 1023 |
| 16383 | 1023 |
| 16384 | 1023 |
| 16385 | 1023 |
| 16386 | 1023 |
| 16387 | 1023 |
| 16388 | 1023 |
| 16389 | 1023 |
| 16390 | 1023 |
| 16391 | 1023 |
| 16392 | 1023 |
| 16393 | 1023 |
| 16394 | 1023 |
| 16395 | 1023 |
| 16396 | 1023 |
| 16397 | 1023 |
| 16398 | 1023 |
| 16399 | 1023 |
| 16400 | 1023 |
| 16401 | 1023 |
| 16402 | 1023 |
| 16403 | 1023 |
| 16404 | 1023 |
| 16405 | 1023 |
| 16406 | 1023 |
| 16407 | 1023 |
| 16408 | 1023 |
| 16409 | 1023 |
| 16410 | 1023 |
| 16411 | 1023 |
| 16412 | 1023 |
| 16413 | 1023 |
| 16414 | 0 |
| 16415 | 0 |
| 16416 | 0 |
| 16417 | 0 |
| 16418 | 0 |
| 16419 | 0 |
| 16420 | 0 |
| 16421 | 0 |
| 16422 | 0 |
| 16423 | 0 |
| 16424 | 0 |
| 16425 | 0 |
| 16426 | 0 |
| 16427 | 0 |
| 16428 | 0 |
| 16429 | 1023 |
| 16430 | 1023 |
| 16431 | 1023 |
| 16432 | 1023 |
| 16433 | 1023 |
| 16434 | 1023 |
| 16435 | 1023 |
| 16436 | 1023 |
| 16437 | 1023 |
| 16438 | 1023 |
| 16439 | 1023 |
| 16440 | 1023 |
| 16441 | 1023 |
| 16442 | 1023 |
| 16443 | 1023 |
| 16444 | 1023 |
| 16445 | 1023 |
| 16446 | 1023 |
| 16447 | 1023 |
| 16448 | 1023 |
| 16449 | 1023 |
| 16450 | 1023 |
| 16451 | 1023 |
| 16452 | 1023 |
| 16453 | 1023 |
| 16454 | 1023 |
| 16455 | 1023 |
| 16456 | 1023 |
| 16457 | 1023 |
| 16458 | 1023 |
| 16459 | 1023 |
| 16460 | 1023 |
| 16461 | 1023 |
| 16462 | 1023 |
| 16463 | 1023 |
| 16464 | 1023 |
| 16465 | 1023 |
| 16466 | 80 |
| 16467 | 0 |
| 16468 | 0 |
| 16469 | 0 |
| 16470 | 0 |
| 16471 | 0 |
| 16472 | 0 |
| 16473 | 0 |
| 16474 | 0 |
| 16475 | 0 |
| 16476 | 0 |
| 16477 | 0 |
| 16478 | 0 |
| 16479 | 0 |
| 16480 | 0 |
| 16481 | 1023 |
| 16482 | 1023 |
| 16483 | 1023 |
| 16484 | 1023 |
| 16485 | 1023 |
| 16486 | 1023 |
| 16487 | 1023 |
| 16488 | 1023 |
| 16489 | 1023 |
| 16490 | 1023 |
| 16491 | 1023 |
| 16492 | 1023 |
| 16493 | 1023 |
| 16494 | 1023 |
| 16495 | 1023 |
| 16496 | 1023 |
| 16497 | 1023 |
| 16498 | 1023 |
| 16499 | 1023 |
| 16500 | 1023 |
| 16501 | 1023 |
| 16502 | 1023 |
| 16503 | 1023 |
| 16504 | 1023 |
| 16505 | 1023 |
| 16506 | 1023 |
| 16507 | 1023 |
| 16508 | 1023 |
| 16509 | 1023 |
| 16510 | 1023 |
| 16511 | 1023 |
| 16512 | 1023 |
| 16513 | 1023 |
| 16514 | 1023 |
| 16515 | 1023 |
| 16516 | 1023 |
| 16517 | 1023 |
| 16518 | 0 |
| 16519 | 0 |
| 16520 | 0 |
| 16521 | 0 |
| 16522 | 0 |
| 16523 | 0 |
| 16524 | 0 |
| 16525 | 0 |
| 16526 | 0 |
| 16527 | 0 |
| 16528 | 0 |
| 16529 | 0 |
| 16530 | 0 |
| 16531 | 0 |
| 16532 | 0 |
| 16533 | 1023 |
| 16534 | 1023 |
| 16535 | 1023 |
| 16536 | 1023 |
| 16537 | 1023 |
| 16538 | 1023 |
| 16539 | 1023 |
| 16540 | 1023 |
| 16541 | 1023 |
| 16542 | 1023 |
| 16543 | 1023 |
| 16544 | 1023 |
| 16545 | 1023 |
| 16546 | 1023 |
| 16547 | 1023 |
| 16548 | 1023 |
| 16549 | 1023 |
| 16550 | 1023 |
| 16551 | 1023 |
| 16552 | 1023 |
| 16553 | 1023 |
| 16554 | 1023 |
| 16555 | 1023 |
| 16556 | 1023 |
| 16557 | 1023 |
| 16558 | 1023 |
| 16559 | 1023 |
| 16560 | 1023 |
| 16561 | 1023 |
| 16562 | 1023 |
| 16563 | 1023 |
| 16564 | 1023 |
| 16565 | 1023 |
| 16566 | 1023 |
| 16567 | 1023 |
| 16568 | 1023 |
| 16569 | 1023 |
| 16570 | 0 |
| 16571 | 0 |
| 16572 | 0 |
| 16573 | 0 |
| 16574 | 0 |
| 16575 | 0 |
| 16576 | 0 |
| 16577 | 0 |
| 16578 | 0 |
| 16579 | 0 |
| 16580 | 0 |
| 16581 | 0 |
| 16582 | 0 |
| 16583 | 0 |
| 16584 | 0 |
| 16585 | 1023 |
| 16586 | 1023 |
| 16587 | 1023 |
| 16588 | 1023 |
| 16589 | 1023 |
| 16590 | 1023 |
| 16591 | 1023 |
| 16592 | 1023 |
| 16593 | 1023 |
| 16594 | 1023 |
| 16595 | 1023 |
| 16596 | 1023 |
| 16597 | 1023 |
| 16598 | 1023 |
| 16599 | 1023 |
| 16600 | 1023 |
| 16601 | 1023 |
| 16602 | 1023 |
| 16603 | 1023 |
| 16604 | 1023 |
| 16605 | 1023 |
| 16606 | 1023 |
| 16607 | 1023 |
| 16608 | 1023 |
| 16609 | 1023 |
| 16610 | 1023 |
| 16611 | 1023 |
| 16612 | 1023 |
| 16613 | 1023 |
| 16614 | 1023 |
| 16615 | 1023 |
| 16616 | 1023 |
| 16617 | 1023 |
| 16618 | 1023 |
| 16619 | 1023 |
| 16620 | 1023 |
| 16621 | 1023 |
| 16622 | 0 |
| 16623 | 0 |
| 16624 | 0 |
| 16625 | 0 |
| 16626 | 0 |
| 16627 | 0 |
| 16628 | 0 |
| 16629 | 0 |
| 16630 | 0 |
| 16631 | 0 |
| 16632 | 0 |
| 16633 | 0 |
| 16634 | 0 |
| 16635 | 0 |
| 16636 | 0 |
| 16637 | 1023 |
| 16638 | 1023 |
| 16639 | 1023 |
| 16640 | 1023 |
| 16641 | 1023 |
| 16642 | 1023 |
| 16643 | 1023 |
| 16644 | 1023 |
| 16645 | 1023 |
| 16646 | 1023 |
| 16647 | 1023 |
| 16648 | 1023 |
| 16649 | 1023 |
| 16650 | 1023 |
| 16651 | 1023 |
| 16652 | 1023 |
| 16653 | 1023 |
| 16654 | 1023 |
| 16655 | 1023 |
| 16656 | 1023 |
| 16657 | 1023 |
| 16658 | 1023 |
| 16659 | 1023 |
| 16660 | 1023 |
| 16661 | 1023 |
| 16662 | 1023 |
| 16663 | 1023 |
| 16664 | 1023 |
| 16665 | 1023 |
| 16666 | 1023 |
| 16667 | 1023 |
| 16668 | 1023 |
| 16669 | 1023 |
| 16670 | 1023 |
| 16671 | 1023 |
| 16672 | 1023 |
| 16673 | 1023 |
| 16674 | 0 |
| 16675 | 1 |
| 16676 | 0 |
| 16677 | 1 |
| 16678 | 0 |
| 16679 | 0 |
| 16680 | 0 |
| 16681 | 0 |
| 16682 | 0 |
| 16683 | 0 |
| 16684 | 0 |
| 16685 | 0 |
| 16686 | 0 |
| 16687 | 0 |
| 16688 | 0 |
| 16689 | 1023 |
| 16690 | 1023 |
| 16691 | 1023 |
| 16692 | 1023 |
| 16693 | 1023 |
| 16694 | 1023 |
| 16695 | 1023 |
| 16696 | 1023 |
| 16697 | 1023 |
| 16698 | 1023 |
| 16699 | 1023 |
| 16700 | 1023 |
| 16701 | 1023 |
| 16702 | 1023 |
| 16703 | 1023 |
| 16704 | 1023 |
| 16705 | 1023 |
| 16706 | 1023 |
| 16707 | 1023 |
| 16708 | 1023 |
| 16709 | 1023 |
| 16710 | 1023 |
| 16711 | 1023 |
| 16712 | 1023 |
| 16713 | 1023 |
| 16714 | 1023 |
| 16715 | 1023 |
| 16716 | 1023 |
| 16717 | 1023 |
| 16718 | 1023 |
| 16719 | 1023 |
| 16720 | 1023 |
| 16721 | 1023 |
| 16722 | 1023 |
| 16723 | 1023 |
| 16724 | 1023 |
| 16725 | 1023 |
| 16726 | 1023 |
| 16727 | 0 |
| 16728 | 0 |
| 16729 | 0 |
| 16730 | 0 |
| 16731 | 0 |
| 16732 | 0 |
| 16733 | 0 |
| 16734 | 0 |
| 16735 | 0 |
| 16736 | 0 |
| 16737 | 0 |
| 16738 | 0 |
| 16739 | 0 |
| 16740 | 1023 |
| 16741 | 1023 |
| 16742 | 1023 |
| 16743 | 1023 |
| 16744 | 1023 |
| 16745 | 1023 |
| 16746 | 1023 |
| 16747 | 1023 |
| 16748 | 1023 |
| 16749 | 1023 |
| 16750 | 1023 |
| 16751 | 1023 |
| 16752 | 1023 |
| 16753 | 1023 |
| 16754 | 1023 |
| 16755 | 1023 |
| 16756 | 1023 |
| 16757 | 1023 |
| 16758 | 1023 |
| 16759 | 1023 |
| 16760 | 1023 |
| 16761 | 1023 |
| 16762 | 1023 |
| 16763 | 1023 |
| 16764 | 1023 |
| 16765 | 1023 |
| 16766 | 1023 |
| 16767 | 1023 |
| 16768 | 1023 |
| 16769 | 1023 |
| 16770 | 1023 |
| 16771 | 1023 |
| 16772 | 1023 |
| 16773 | 1023 |
| 16774 | 1023 |
| 16775 | 1023 |
| 16776 | 1023 |
| 16777 | 1023 |
| 16778 | 0 |
| 16779 | 0 |
| 16780 | 0 |
| 16781 | 0 |
| 16782 | 0 |
| 16783 | 0 |
| 16784 | 0 |
| 16785 | 0 |
| 16786 | 0 |
| 16787 | 0 |
| 16788 | 0 |
| 16789 | 0 |
| 16790 | 0 |
| 16791 | 1023 |
| 16792 | 1023 |
| 16793 | 1023 |
| 16794 | 1023 |
| 16795 | 1023 |
| 16796 | 1023 |
| 16797 | 1023 |
| 16798 | 1023 |
| 16799 | 1023 |
| 16800 | 1023 |
| 16801 | 1023 |
| 16802 | 1023 |
| 16803 | 1023 |
| 16804 | 1023 |
| 16805 | 1023 |
| 16806 | 1023 |
| 16807 | 1023 |
| 16808 | 1023 |
| 16809 | 1023 |
| 16810 | 1023 |
| 16811 | 1023 |
| 16812 | 1023 |
| 16813 | 1023 |
| 16814 | 1023 |
| 16815 | 1023 |
| 16816 | 1023 |
| 16817 | 1023 |
| 16818 | 1023 |
| 16819 | 1023 |
| 16820 | 1023 |
| 16821 | 1023 |
| 16822 | 1023 |
| 16823 | 1023 |
| 16824 | 1023 |
| 16825 | 1023 |
| 16826 | 1023 |
| 16827 | 1023 |
| 16828 | 1023 |
| 16829 | 0 |
| 16830 | 0 |
| 16831 | 0 |
| 16832 | 0 |
| 16833 | 0 |
| 16834 | 0 |
| 16835 | 0 |
| 16836 | 0 |
| 16837 | 0 |
| 16838 | 0 |
| 16839 | 0 |
| 16840 | 0 |
| 16841 | 0 |
| 16842 | 1023 |
| 16843 | 1023 |
| 16844 | 1023 |
| 16845 | 1023 |
| 16846 | 1023 |
| 16847 | 1023 |
| 16848 | 1023 |
| 16849 | 1023 |
| 16850 | 1023 |
| 16851 | 1023 |
| 16852 | 1023 |
| 16853 | 1023 |
| 16854 | 1023 |
| 16855 | 1023 |
| 16856 | 1023 |
| 16857 | 1023 |
| 16858 | 1023 |
| 16859 | 1023 |
| 16860 | 1023 |
| 16861 | 1023 |
| 16862 | 1023 |
| 16863 | 1023 |
| 16864 | 1023 |
| 16865 | 1023 |
| 16866 | 1023 |
| 16867 | 1023 |
| 16868 | 1023 |
| 16869 | 1023 |
| 16870 | 1023 |
| 16871 | 1023 |
| 16872 | 1023 |
| 16873 | 1023 |
| 16874 | 1023 |
| 16875 | 1023 |
| 16876 | 1023 |
| 16877 | 1023 |
| 16878 | 1023 |
| 16879 | 1023 |
| 16880 | 0 |
| 16881 | 0 |
| 16882 | 1 |
| 16883 | 0 |
| 16884 | 0 |
| 16885 | 0 |
| 16886 | 0 |
| 16887 | 0 |
| 16888 | 0 |
| 16889 | 0 |
| 16890 | 0 |
| 16891 | 0 |
| 16892 | 0 |
| 16893 | 1023 |
| 16894 | 1023 |
| 16895 | 1023 |
| 16896 | 1023 |
| 16897 | 1023 |
| 16898 | 1023 |
| 16899 | 1023 |
| 16900 | 1023 |
| 16901 | 1023 |
| 16902 | 1023 |
| 16903 | 1023 |
| 16904 | 1023 |
| 16905 | 1023 |
| 16906 | 1023 |
| 16907 | 1023 |
| 16908 | 1023 |
| 16909 | 1023 |
| 16910 | 1023 |
| 16911 | 1023 |
| 16912 | 1023 |
| 16913 | 1023 |
| 16914 | 1023 |
| 16915 | 1023 |
| 16916 | 1023 |
| 16917 | 1023 |
| 16918 | 1023 |
| 16919 | 1023 |
| 16920 | 1023 |
| 16921 | 1023 |
| 16922 | 1023 |
| 16923 | 1023 |
| 16924 | 1023 |
| 16925 | 1023 |
| 16926 | 1023 |
| 16927 | 1023 |
| 16928 | 1023 |
| 16929 | 1023 |
| 16930 | 1023 |
| 16931 | 0 |
| 16932 | 0 |
| 16933 | 0 |
| 16934 | 0 |
| 16935 | 0 |
| 16936 | 0 |
| 16937 | 0 |
| 16938 | 0 |
| 16939 | 0 |
| 16940 | 0 |
| 16941 | 0 |
| 16942 | 0 |
| 16943 | 0 |
| 16944 | 1023 |
| 16945 | 1023 |
| 16946 | 1023 |
| 16947 | 1023 |
| 16948 | 1023 |
| 16949 | 1023 |
| 16950 | 1023 |
| 16951 | 1023 |
| 16952 | 1023 |
| 16953 | 1023 |
| 16954 | 1023 |
| 16955 | 1023 |
| 16956 | 1023 |
| 16957 | 1023 |
| 16958 | 1023 |
| 16959 | 1023 |
| 16960 | 1023 |
| 16961 | 1023 |
| 16962 | 1023 |
| 16963 | 1023 |
| 16964 | 1023 |
| 16965 | 1023 |
| 16966 | 1023 |
| 16967 | 1023 |
| 16968 | 1023 |
| 16969 | 1023 |
| 16970 | 1023 |
| 16971 | 1023 |
| 16972 | 1023 |
| 16973 | 1023 |
| 16974 | 1023 |
| 16975 | 1023 |
| 16976 | 1023 |
| 16977 | 1023 |
| 16978 | 1023 |
| 16979 | 1023 |
| 16980 | 1023 |
| 16981 | 1023 |
| 16982 | 0 |
| 16983 | 0 |
| 16984 | 0 |
| 16985 | 0 |
| 16986 | 0 |
| 16987 | 0 |
| 16988 | 0 |
| 16989 | 0 |
| 16990 | 0 |
| 16991 | 0 |
| 16992 | 0 |
| 16993 | 0 |
| 16994 | 1 |
| 16995 | 1023 |
| 16996 | 1023 |
| 16997 | 1023 |
| 16998 | 1023 |
| 16999 | 1023 |
| 17000 | 1023 |
| 17001 | 1023 |
| 17002 | 1023 |
| 17003 | 1023 |
| 17004 | 1023 |
| 17005 | 1023 |
| 17006 | 1023 |
| 17007 | 1023 |
| 17008 | 1023 |
| 17009 | 1023 |
| 17010 | 1023 |
| 17011 | 1023 |
| 17012 | 1023 |
| 17013 | 1023 |
| 17014 | 1023 |
| 17015 | 1023 |
| 17016 | 1023 |
| 17017 | 1023 |
| 17018 | 1023 |
| 17019 | 1023 |
| 17020 | 1023 |
| 17021 | 1023 |
| 17022 | 1023 |
| 17023 | 1023 |
| 17024 | 1023 |
| 17025 | 1023 |
| 17026 | 1023 |
| 17027 | 1023 |
| 17028 | 1023 |
| 17029 | 1023 |
| 17030 | 1023 |
| 17031 | 1023 |
| 17032 | 1023 |
| 17033 | 0 |
| 17034 | 0 |
| 17035 | 0 |
| 17036 | 0 |
| 17037 | 0 |
| 17038 | 0 |
| 17039 | 0 |
| 17040 | 0 |
| 17041 | 0 |
| 17042 | 0 |
| 17043 | 0 |
| 17044 | 0 |
| 17045 | 0 |
| 17046 | 0 |
| 17047 | 1023 |
| 17048 | 1023 |
| 17049 | 1023 |
| 17050 | 1023 |
| 17051 | 1023 |
| 17052 | 1023 |
| 17053 | 1023 |
| 17054 | 1023 |
| 17055 | 1023 |
| 17056 | 1023 |
| 17057 | 1023 |
| 17058 | 1023 |
| 17059 | 1023 |
| 17060 | 1023 |
| 17061 | 1023 |
| 17062 | 1023 |
| 17063 | 1023 |
| 17064 | 1023 |
| 17065 | 1023 |
| 17066 | 1023 |
| 17067 | 1023 |
| 17068 | 1023 |
| 17069 | 1023 |
| 17070 | 1023 |
| 17071 | 1023 |
| 17072 | 1023 |
| 17073 | 1023 |
| 17074 | 1023 |
| 17075 | 1023 |
| 17076 | 1023 |
| 17077 | 1023 |
| 17078 | 1023 |
| 17079 | 1023 |
| 17080 | 1023 |
| 17081 | 1023 |
| 17082 | 1023 |
| 17083 | 1023 |
| 17084 | 0 |
| 17085 | 0 |
| 17086 | 0 |
| 17087 | 0 |
| 17088 | 0 |
| 17089 | 0 |
| 17090 | 0 |
| 17091 | 0 |
| 17092 | 0 |
| 17093 | 0 |
| 17094 | 0 |
| 17095 | 0 |
| 17096 | 0 |
| 17097 | 0 |
| 17098 | 1023 |
| 17099 | 1023 |
| 17100 | 1023 |
| 17101 | 1023 |
| 17102 | 1023 |
| 17103 | 1023 |
| 17104 | 1023 |
| 17105 | 1023 |
| 17106 | 1023 |
| 17107 | 1023 |
| 17108 | 1023 |
| 17109 | 1023 |
| 17110 | 1023 |
| 17111 | 1023 |
| 17112 | 1023 |
| 17113 | 1023 |
| 17114 | 1023 |
| 17115 | 1023 |
| 17116 | 1023 |
| 17117 | 1023 |
| 17118 | 1023 |
| 17119 | 1023 |
| 17120 | 1023 |
| 17121 | 1023 |
| 17122 | 1023 |
| 17123 | 1023 |
| 17124 | 1023 |
| 17125 | 1023 |
| 17126 | 1023 |
| 17127 | 1023 |
| 17128 | 1023 |
| 17129 | 1023 |
| 17130 | 1023 |
| 17131 | 1023 |
| 17132 | 1023 |
| 17133 | 1023 |
| 17134 | 1023 |
| 17135 | 1023 |
| 17136 | 0 |
| 17137 | 0 |
| 17138 | 0 |
| 17139 | 0 |
| 17140 | 0 |
| 17141 | 0 |
| 17142 | 0 |
| 17143 | 0 |
| 17144 | 0 |
| 17145 | 0 |
| 17146 | 0 |
| 17147 | 0 |
| 17148 | 0 |
| 17149 | 0 |
| 17150 | 1023 |
| 17151 | 1023 |
| 17152 | 1023 |
| 17153 | 1023 |
| 17154 | 1023 |
| 17155 | 1023 |
| 17156 | 1023 |
| 17157 | 1023 |
| 17158 | 1023 |
| 17159 | 1023 |
| 17160 | 1023 |
| 17161 | 1023 |
| 17162 | 1023 |
| 17163 | 1023 |
| 17164 | 1023 |
| 17165 | 1023 |
| 17166 | 1023 |
| 17167 | 1023 |
| 17168 | 1023 |
| 17169 | 1023 |
| 17170 | 1023 |
| 17171 | 1023 |
| 17172 | 1023 |
| 17173 | 1023 |
| 17174 | 1023 |
| 17175 | 1023 |
| 17176 | 1023 |
| 17177 | 1023 |
| 17178 | 1023 |
| 17179 | 1023 |
| 17180 | 1023 |
| 17181 | 1023 |
| 17182 | 1023 |
| 17183 | 1023 |
| 17184 | 1023 |
| 17185 | 1023 |
| 17186 | 1023 |
| 17187 | 0 |
| 17188 | 0 |
| 17189 | 0 |
| 17190 | 0 |
| 17191 | 0 |
| 17192 | 0 |
| 17193 | 0 |
| 17194 | 0 |
| 17195 | 0 |
| 17196 | 0 |
| 17197 | 0 |
| 17198 | 0 |
| 17199 | 0 |
| 17200 | 0 |
| 17201 | 0 |
| 17202 | 1023 |
| 17203 | 1023 |
| 17204 | 1023 |
| 17205 | 1023 |
| 17206 | 1023 |
| 17207 | 1023 |
| 17208 | 1023 |
| 17209 | 1023 |
| 17210 | 1023 |
| 17211 | 1023 |
| 17212 | 1023 |
| 17213 | 1023 |
| 17214 | 1023 |
| 17215 | 1023 |
| 17216 | 1023 |
| 17217 | 1023 |
| 17218 | 1023 |
| 17219 | 1023 |
| 17220 | 1023 |
| 17221 | 1023 |
| 17222 | 1023 |
| 17223 | 1023 |
| 17224 | 1023 |
| 17225 | 1023 |
| 17226 | 1023 |
| 17227 | 1023 |
| 17228 | 1023 |
| 17229 | 1023 |
| 17230 | 1023 |
| 17231 | 1023 |
| 17232 | 1023 |
| 17233 | 1023 |
| 17234 | 1023 |
| 17235 | 1023 |
| 17236 | 1023 |
| 17237 | 1023 |
| 17238 | 1023 |
| 17239 | 0 |
| 17240 | 0 |
| 17241 | 0 |
| 17242 | 0 |
| 17243 | 0 |
| 17244 | 0 |
| 17245 | 0 |
| 17246 | 0 |
| 17247 | 0 |
| 17248 | 0 |
| 17249 | 0 |
| 17250 | 0 |
| 17251 | 0 |
| 17252 | 0 |
| 17253 | 0 |
| 17254 | 1023 |
| 17255 | 1023 |
| 17256 | 1023 |
| 17257 | 1023 |
| 17258 | 1023 |
| 17259 | 1023 |
| 17260 | 1023 |
| 17261 | 1023 |
| 17262 | 1023 |
| 17263 | 1023 |
| 17264 | 1023 |
| 17265 | 1023 |
| 17266 | 1023 |
| 17267 | 1023 |
| 17268 | 1023 |
| 17269 | 1023 |
| 17270 | 1023 |
| 17271 | 1023 |
| 17272 | 1023 |
| 17273 | 1023 |
| 17274 | 1023 |
| 17275 | 1023 |
| 17276 | 1023 |
| 17277 | 1023 |
| 17278 | 1023 |
| 17279 | 1023 |
| 17280 | 1023 |
| 17281 | 1023 |
| 17282 | 1023 |
| 17283 | 1023 |
| 17284 | 1023 |
| 17285 | 1023 |
| 17286 | 1023 |
| 17287 | 1023 |
| 17288 | 1023 |
| 17289 | 1023 |
| 17290 | 1023 |
| 17291 | 453 |
| 17292 | 0 |
| 17293 | 0 |
| 17294 | 0 |
| 17295 | 0 |
| 17296 | 0 |
| 17297 | 0 |
| 17298 | 0 |
| 17299 | 0 |
| 17300 | 0 |
| 17301 | 0 |
| 17302 | 0 |
| 17303 | 0 |
| 17304 | 0 |
| 17305 | 1023 |
| 17306 | 1023 |
| 17307 | 1023 |
| 17308 | 1023 |
| 17309 | 1023 |
| 17310 | 1023 |
| 17311 | 1023 |
| 17312 | 1023 |
| 17313 | 1023 |
| 17314 | 1023 |
| 17315 | 1023 |
| 17316 | 1023 |
| 17317 | 1023 |
| 17318 | 1023 |
| 17319 | 1023 |
| 17320 | 1023 |
| 17321 | 1023 |
| 17322 | 1023 |
| 17323 | 1023 |
| 17324 | 1023 |
| 17325 | 1023 |
| 17326 | 1023 |
| 17327 | 1023 |
| 17328 | 1023 |
| 17329 | 1023 |
| 17330 | 1023 |
| 17331 | 1023 |
| 17332 | 1023 |
| 17333 | 1023 |
| 17334 | 1023 |
| 17335 | 1023 |
| 17336 | 1023 |
| 17337 | 1023 |
| 17338 | 1023 |
| 17339 | 1023 |
| 17340 | 1023 |
| 17341 | 1023 |
| 17342 | 1023 |
| 17343 | 0 |
| 17344 | 0 |
| 17345 | 0 |
| 17346 | 0 |
| 17347 | 0 |
| 17348 | 0 |
| 17349 | 0 |
| 17350 | 0 |
| 17351 | 0 |
| 17352 | 0 |
| 17353 | 0 |
| 17354 | 0 |
| 17355 | 0 |
| 17356 | 1023 |
| 17357 | 1023 |
| 17358 | 1023 |
| 17359 | 1023 |
| 17360 | 1023 |
| 17361 | 1023 |
| 17362 | 1023 |
| 17363 | 1023 |
| 17364 | 1023 |
| 17365 | 1023 |
| 17366 | 1023 |
| 17367 | 1023 |
| 17368 | 1023 |
| 17369 | 1023 |
| 17370 | 1023 |
| 17371 | 1023 |
| 17372 | 1023 |
| 17373 | 1023 |
| 17374 | 1023 |
| 17375 | 1023 |
| 17376 | 1023 |
| 17377 | 1023 |
| 17378 | 1023 |
| 17379 | 1023 |
| 17380 | 1023 |
| 17381 | 1023 |
| 17382 | 1023 |
| 17383 | 1023 |
| 17384 | 1023 |
| 17385 | 1023 |
| 17386 | 1023 |
| 17387 | 1023 |
| 17388 | 1023 |
| 17389 | 1023 |
| 17390 | 1023 |
| 17391 | 1023 |
| 17392 | 1023 |
| 17393 | 1023 |
| 17394 | 0 |
| 17395 | 0 |
| 17396 | 0 |
| 17397 | 0 |
| 17398 | 0 |
| 17399 | 0 |
| 17400 | 0 |
| 17401 | 0 |
| 17402 | 0 |
| 17403 | 0 |
| 17404 | 0 |
| 17405 | 0 |
| 17406 | 0 |
| 17407 | 1023 |
| 17408 | 1023 |
| 17409 | 1023 |
| 17410 | 1023 |
| 17411 | 1023 |
| 17412 | 1023 |
| 17413 | 1023 |
| 17414 | 1023 |
| 17415 | 1023 |
| 17416 | 1023 |
| 17417 | 1023 |
| 17418 | 1023 |
| 17419 | 1023 |
| 17420 | 1023 |
| 17421 | 1023 |
| 17422 | 1023 |
| 17423 | 1023 |
| 17424 | 1023 |
| 17425 | 1023 |
| 17426 | 1023 |
| 17427 | 1023 |
| 17428 | 1023 |
| 17429 | 1023 |
| 17430 | 1023 |
| 17431 | 1023 |
| 17432 | 1023 |
| 17433 | 1023 |
| 17434 | 1023 |
| 17435 | 1023 |
| 17436 | 1023 |
| 17437 | 1023 |
| 17438 | 1023 |
| 17439 | 1023 |
| 17440 | 1023 |
| 17441 | 1023 |
| 17442 | 1023 |
| 17443 | 1023 |
| 17444 | 1023 |
| 17445 | 0 |
| 17446 | 0 |
| 17447 | 0 |
| 17448 | 0 |
| 17449 | 0 |
| 17450 | 0 |
| 17451 | 0 |
| 17452 | 0 |
| 17453 | 0 |
| 17454 | 0 |
| 17455 | 0 |
| 17456 | 0 |
| 17457 | 0 |
| 17458 | 0 |
| 17459 | 1023 |
| 17460 | 1023 |
| 17461 | 1023 |
| 17462 | 1023 |
| 17463 | 1023 |
| 17464 | 1023 |
| 17465 | 1023 |
| 17466 | 1023 |
| 17467 | 1023 |
| 17468 | 1023 |
| 17469 | 1023 |
| 17470 | 1023 |
| 17471 | 1023 |
| 17472 | 1023 |
| 17473 | 1023 |
| 17474 | 1023 |
| 17475 | 1023 |
| 17476 | 1023 |
| 17477 | 1023 |
| 17478 | 1023 |
| 17479 | 1023 |
| 17480 | 1023 |
| 17481 | 1023 |
| 17482 | 1023 |
| 17483 | 1023 |
| 17484 | 1023 |
| 17485 | 1023 |
| 17486 | 1023 |
| 17487 | 1023 |
| 17488 | 1023 |
| 17489 | 1023 |
| 17490 | 1023 |
| 17491 | 1023 |
| 17492 | 1023 |
| 17493 | 1023 |
| 17494 | 1023 |
| 17495 | 1023 |
| 17496 | 0 |
| 17497 | 0 |
| 17498 | 0 |
| 17499 | 0 |
| 17500 | 0 |
| 17501 | 0 |
| 17502 | 0 |
| 17503 | 0 |
| 17504 | 0 |
| 17505 | 0 |
| 17506 | 0 |
| 17507 | 0 |
| 17508 | 0 |
| 17509 | 0 |
| 17510 | 1023 |
| 17511 | 1023 |
| 17512 | 1023 |
| 17513 | 1023 |
| 17514 | 1023 |
| 17515 | 1023 |
| 17516 | 1023 |
| 17517 | 1023 |
| 17518 | 1023 |
| 17519 | 1023 |
| 17520 | 1023 |
| 17521 | 1023 |
| 17522 | 1023 |
| 17523 | 1023 |
| 17524 | 1023 |
| 17525 | 1023 |
| 17526 | 1023 |
| 17527 | 1023 |
| 17528 | 1023 |
| 17529 | 1023 |
| 17530 | 1023 |
| 17531 | 1023 |
| 17532 | 1023 |
| 17533 | 1023 |
| 17534 | 1023 |
| 17535 | 1023 |
| 17536 | 1023 |
| 17537 | 1023 |
| 17538 | 1023 |
| 17539 | 1023 |
| 17540 | 1023 |
| 17541 | 1023 |
| 17542 | 1023 |
| 17543 | 1023 |
| 17544 | 1023 |
| 17545 | 1023 |
| 17546 | 1023 |
| 17547 | 1023 |
| 17548 | 0 |
| 17549 | 0 |
| 17550 | 0 |
| 17551 | 0 |
| 17552 | 0 |
| 17553 | 0 |
| 17554 | 0 |
| 17555 | 0 |
| 17556 | 0 |
| 17557 | 0 |
| 17558 | 0 |
| 17559 | 0 |
| 17560 | 0 |
| 17561 | 0 |
| 17562 | 1023 |
| 17563 | 1023 |
| 17564 | 1023 |
| 17565 | 1023 |
| 17566 | 1023 |
| 17567 | 1023 |
| 17568 | 1023 |
| 17569 | 1023 |
| 17570 | 1023 |
| 17571 | 1023 |
| 17572 | 1023 |
| 17573 | 1023 |
| 17574 | 1023 |
| 17575 | 1023 |
| 17576 | 1023 |
| 17577 | 1023 |
| 17578 | 1023 |
| 17579 | 1023 |
| 17580 | 1023 |
| 17581 | 1023 |
| 17582 | 1023 |
| 17583 | 1023 |
| 17584 | 1023 |
| 17585 | 1023 |
| 17586 | 1023 |
| 17587 | 1023 |
| 17588 | 1023 |
| 17589 | 1023 |
| 17590 | 1023 |
| 17591 | 1023 |
| 17592 | 1023 |
| 17593 | 1023 |
| 17594 | 1023 |
| 17595 | 1023 |
| 17596 | 1023 |
| 17597 | 1023 |
| 17598 | 1023 |
| 17599 | 0 |
| 17600 | 0 |
| 17601 | 0 |
| 17602 | 0 |
| 17603 | 0 |
| 17604 | 0 |
| 17605 | 0 |
| 17606 | 0 |
| 17607 | 0 |
| 17608 | 0 |
| 17609 | 0 |
| 17610 | 0 |
| 17611 | 0 |
| 17612 | 0 |
| 17613 | 0 |
| 17614 | 1023 |
| 17615 | 1023 |
| 17616 | 1023 |
| 17617 | 1023 |
| 17618 | 1023 |
| 17619 | 1023 |
| 17620 | 1023 |
| 17621 | 1023 |
| 17622 | 1023 |
| 17623 | 1023 |
| 17624 | 1023 |
| 17625 | 1023 |
| 17626 | 1023 |
| 17627 | 1023 |
| 17628 | 1023 |
| 17629 | 1023 |
| 17630 | 1023 |
| 17631 | 1023 |
| 17632 | 1023 |
| 17633 | 1023 |
| 17634 | 1023 |
| 17635 | 1023 |
| 17636 | 1023 |
| 17637 | 1023 |
| 17638 | 1023 |
| 17639 | 1023 |
| 17640 | 1023 |
| 17641 | 1023 |
| 17642 | 1023 |
| 17643 | 1023 |
| 17644 | 1023 |
| 17645 | 1023 |
| 17646 | 1023 |
| 17647 | 1023 |
| 17648 | 1023 |
| 17649 | 1023 |
| 17650 | 1023 |
| 17651 | 0 |
| 17652 | 0 |
| 17653 | 0 |
| 17654 | 0 |
| 17655 | 0 |
| 17656 | 0 |
| 17657 | 0 |
| 17658 | 0 |
| 17659 | 0 |
| 17660 | 0 |
| 17661 | 0 |
| 17662 | 0 |
| 17663 | 0 |
| 17664 | 0 |
| 17665 | 0 |
| 17666 | 1023 |
| 17667 | 1023 |
| 17668 | 1023 |
| 17669 | 1023 |
| 17670 | 1023 |
| 17671 | 1023 |
| 17672 | 1023 |
| 17673 | 1023 |
| 17674 | 1023 |
| 17675 | 1023 |
| 17676 | 1023 |
| 17677 | 1023 |
| 17678 | 1023 |
| 17679 | 1023 |
| 17680 | 1023 |
| 17681 | 1023 |
| 17682 | 1023 |
| 17683 | 1023 |
| 17684 | 1023 |
| 17685 | 1023 |
| 17686 | 1023 |
| 17687 | 1023 |
| 17688 | 1023 |
| 17689 | 1023 |
| 17690 | 1023 |
| 17691 | 1023 |
| 17692 | 1023 |
| 17693 | 1023 |
| 17694 | 1023 |
| 17695 | 1023 |
| 17696 | 1023 |
| 17697 | 1023 |
| 17698 | 1023 |
| 17699 | 1023 |
| 17700 | 1023 |
| 17701 | 1023 |
| 17702 | 1023 |
| 17703 | 0 |
| 17704 | 0 |
| 17705 | 0 |
| 17706 | 0 |
| 17707 | 0 |
| 17708 | 0 |
| 17709 | 0 |
| 17710 | 0 |
| 17711 | 0 |
| 17712 | 0 |
| 17713 | 0 |
| 17714 | 0 |
| 17715 | 0 |
| 17716 | 0 |
| 17717 | 0 |
| 17718 | 1023 |
| 17719 | 1023 |
| 17720 | 1023 |
| 17721 | 1023 |
| 17722 | 1023 |
| 17723 | 1023 |
| 17724 | 1023 |
| 17725 | 1023 |
| 17726 | 1023 |
| 17727 | 1023 |
| 17728 | 1023 |
| 17729 | 1023 |
| 17730 | 1023 |
| 17731 | 1023 |
| 17732 | 1023 |
| 17733 | 1023 |
| 17734 | 1023 |
| 17735 | 1023 |
| 17736 | 1023 |
| 17737 | 1023 |
| 17738 | 1023 |
| 17739 | 1023 |
| 17740 | 1023 |
| 17741 | 1023 |
| 17742 | 1023 |
| 17743 | 1023 |
| 17744 | 1023 |
| 17745 | 1023 |
| 17746 | 1023 |
| 17747 | 1023 |
| 17748 | 1023 |
| 17749 | 1023 |
| 17750 | 1023 |
| 17751 | 1023 |
| 17752 | 1023 |
| 17753 | 1023 |
| 17754 | 1023 |
| 17755 | 1023 |
| 17756 | 0 |
| 17757 | 0 |
| 17758 | 0 |
| 17759 | 0 |
| 17760 | 0 |
| 17761 | 0 |
| 17762 | 0 |
| 17763 | 0 |
| 17764 | 0 |
| 17765 | 0 |
| 17766 | 0 |
| 17767 | 0 |
| 17768 | 0 |
| 17769 | 1023 |
| 17770 | 1023 |
| 17771 | 1023 |
| 17772 | 1023 |
| 17773 | 1023 |
| 17774 | 1023 |
| 17775 | 1023 |
| 17776 | 1023 |
| 17777 | 1023 |
| 17778 | 1023 |
| 17779 | 1023 |
| 17780 | 1023 |
| 17781 | 1023 |
| 17782 | 1023 |
| 17783 | 1023 |
| 17784 | 1023 |
| 17785 | 1023 |
| 17786 | 1023 |
| 17787 | 1023 |
| 17788 | 1023 |
| 17789 | 1023 |
| 17790 | 1023 |
| 17791 | 1023 |
| 17792 | 1023 |
| 17793 | 1023 |
| 17794 | 1023 |
| 17795 | 1023 |
| 17796 | 1023 |
| 17797 | 1023 |
| 17798 | 1023 |
| 17799 | 1023 |
| 17800 | 1023 |
| 17801 | 1023 |
| 17802 | 1023 |
| 17803 | 1023 |
| 17804 | 1023 |
| 17805 | 1023 |
| 17806 | 1023 |
| 17807 | 0 |
| 17808 | 0 |
| 17809 | 0 |
| 17810 | 0 |
| 17811 | 0 |
| 17812 | 0 |
| 17813 | 0 |
| 17814 | 0 |
| 17815 | 0 |
| 17816 | 0 |
| 17817 | 0 |
| 17818 | 0 |
| 17819 | 0 |
| 17820 | 1023 |
| 17821 | 1023 |
| 17822 | 1023 |
| 17823 | 1023 |
| 17824 | 1023 |
| 17825 | 1023 |
| 17826 | 1023 |
| 17827 | 1023 |
| 17828 | 1023 |
| 17829 | 1023 |
| 17830 | 1023 |
| 17831 | 1023 |
| 17832 | 1023 |
| 17833 | 1023 |
| 17834 | 1023 |
| 17835 | 1023 |
| 17836 | 1023 |
| 17837 | 1023 |
| 17838 | 1023 |
| 17839 | 1023 |
| 17840 | 1023 |
| 17841 | 1023 |
| 17842 | 1023 |
| 17843 | 1023 |
| 17844 | 1023 |
| 17845 | 1023 |
| 17846 | 1023 |
| 17847 | 1023 |
| 17848 | 1023 |
| 17849 | 1023 |
| 17850 | 1023 |
| 17851 | 1023 |
| 17852 | 1023 |
| 17853 | 1023 |
| 17854 | 1023 |
| 17855 | 1023 |
| 17856 | 1023 |
| 17857 | 1023 |
| 17858 | 0 |
| 17859 | 0 |
| 17860 | 0 |
| 17861 | 0 |
| 17862 | 1 |
| 17863 | 0 |
| 17864 | 0 |
| 17865 | 0 |
| 17866 | 0 |
| 17867 | 0 |
| 17868 | 0 |
| 17869 | 0 |
| 17870 | 0 |
| 17871 | 1023 |
| 17872 | 1023 |
| 17873 | 1023 |
| 17874 | 1023 |
| 17875 | 1023 |
| 17876 | 1023 |
| 17877 | 1023 |
| 17878 | 1023 |
| 17879 | 1023 |
| 17880 | 1023 |
| 17881 | 1023 |
| 17882 | 1023 |
| 17883 | 1023 |
| 17884 | 1023 |
| 17885 | 1023 |
| 17886 | 1023 |
| 17887 | 1023 |
| 17888 | 1023 |
| 17889 | 1023 |
| 17890 | 1023 |
| 17891 | 1023 |
| 17892 | 1023 |
| 17893 | 1023 |
| 17894 | 1023 |
| 17895 | 1023 |
| 17896 | 1023 |
| 17897 | 1023 |
| 17898 | 1023 |
| 17899 | 1023 |
| 17900 | 1023 |
| 17901 | 1023 |
| 17902 | 1023 |
| 17903 | 1023 |
| 17904 | 1023 |
| 17905 | 1023 |
| 17906 | 1023 |
| 17907 | 1023 |
| 17908 | 1023 |
| 17909 | 0 |
| 17910 | 0 |
| 17911 | 0 |
| 17912 | 0 |
| 17913 | 0 |
| 17914 | 0 |
| 17915 | 0 |
| 17916 | 0 |
| 17917 | 0 |
| 17918 | 0 |
| 17919 | 0 |
| 17920 | 0 |
| 17921 | 0 |
| 17922 | 1023 |
| 17923 | 1023 |
| 17924 | 1023 |
| 17925 | 1023 |
| 17926 | 1023 |
| 17927 | 1023 |
| 17928 | 1023 |
| 17929 | 1023 |
| 17930 | 1023 |
| 17931 | 1023 |
| 17932 | 1023 |
| 17933 | 1023 |
| 17934 | 1023 |
| 17935 | 1023 |
| 17936 | 1023 |
| 17937 | 1023 |
| 17938 | 1023 |
| 17939 | 1023 |
| 17940 | 1023 |
| 17941 | 1023 |
| 17942 | 1023 |
| 17943 | 1023 |
| 17944 | 1023 |
| 17945 | 1023 |
| 17946 | 1023 |
| 17947 | 1023 |
| 17948 | 1023 |
| 17949 | 1023 |
| 17950 | 1023 |
| 17951 | 1023 |
| 17952 | 1023 |
| 17953 | 1023 |
| 17954 | 1023 |
| 17955 | 1023 |
| 17956 | 1023 |
| 17957 | 1023 |
| 17958 | 1023 |
| 17959 | 1023 |
| 17960 | 0 |
| 17961 | 0 |
| 17962 | 0 |
| 17963 | 0 |
| 17964 | 0 |
| 17965 | 0 |
| 17966 | 0 |
| 17967 | 0 |
| 17968 | 0 |
| 17969 | 0 |
| 17970 | 0 |
| 17971 | 0 |
| 17972 | 0 |
| 17973 | 1023 |
| 17974 | 1023 |
| 17975 | 1023 |
| 17976 | 1023 |
| 17977 | 1023 |
| 17978 | 1023 |
| 17979 | 1023 |
| 17980 | 1023 |
| 17981 | 1023 |
| 17982 | 1023 |
| 17983 | 1023 |
| 17984 | 1023 |
| 17985 | 1023 |
| 17986 | 1023 |
| 17987 | 1023 |
| 17988 | 1023 |
| 17989 | 1023 |
| 17990 | 1023 |
| 17991 | 1023 |
| 17992 | 1023 |
| 17993 | 1023 |
| 17994 | 1023 |
| 17995 | 1023 |
| 17996 | 1023 |
| 17997 | 1023 |
| 17998 | 1023 |
| 17999 | 1023 |
| 18000 | 1023 |
| 18001 | 1023 |
| 18002 | 1023 |
| 18003 | 1023 |
| 18004 | 1023 |
| 18005 | 1023 |
| 18006 | 1023 |
| 18007 | 1023 |
| 18008 | 1023 |
| 18009 | 1023 |
| 18010 | 1023 |
| 18011 | 0 |
| 18012 | 0 |
| 18013 | 0 |
| 18014 | 0 |
| 18015 | 0 |
| 18016 | 0 |
| 18017 | 0 |
| 18018 | 0 |
| 18019 | 0 |
| 18020 | 0 |
| 18021 | 0 |
| 18022 | 0 |
| 18023 | 0 |
| 18024 | 1023 |
| 18025 | 1023 |
| 18026 | 1023 |
| 18027 | 1023 |
| 18028 | 1023 |
| 18029 | 1023 |
| 18030 | 1023 |
| 18031 | 1023 |
| 18032 | 1023 |
| 18033 | 1023 |
| 18034 | 1023 |
| 18035 | 1023 |
| 18036 | 1023 |
| 18037 | 1023 |
| 18038 | 1023 |
| 18039 | 1023 |
| 18040 | 1023 |
| 18041 | 1023 |
| 18042 | 1023 |
| 18043 | 1023 |
| 18044 | 1023 |
| 18045 | 1023 |
| 18046 | 1023 |
| 18047 | 1023 |
| 18048 | 1023 |
| 18049 | 1023 |
| 18050 | 1023 |
| 18051 | 1023 |
| 18052 | 1023 |
| 18053 | 1023 |
| 18054 | 1023 |
| 18055 | 1023 |
| 18056 | 1023 |
| 18057 | 1023 |
| 18058 | 1023 |
| 18059 | 1023 |
| 18060 | 1023 |
| 18061 | 1023 |
| 18062 | 0 |
| 18063 | 0 |
| 18064 | 0 |
| 18065 | 0 |
| 18066 | 0 |
| 18067 | 0 |
| 18068 | 0 |
| 18069 | 0 |
| 18070 | 0 |
| 18071 | 0 |
| 18072 | 0 |
| 18073 | 0 |
| 18074 | 0 |
| 18075 | 0 |
| 18076 | 1023 |
| 18077 | 1023 |
| 18078 | 1023 |
| 18079 | 1023 |
| 18080 | 1023 |
| 18081 | 1023 |
| 18082 | 1023 |
| 18083 | 1023 |
| 18084 | 1023 |
| 18085 | 1023 |
| 18086 | 1023 |
| 18087 | 1023 |
| 18088 | 1023 |
| 18089 | 1023 |
| 18090 | 1023 |
| 18091 | 1023 |
| 18092 | 1023 |
| 18093 | 1023 |
| 18094 | 1023 |
| 18095 | 1023 |
| 18096 | 1023 |
| 18097 | 1023 |
| 18098 | 1023 |
| 18099 | 1023 |
| 18100 | 1023 |
| 18101 | 1023 |
| 18102 | 1023 |
| 18103 | 1023 |
| 18104 | 1023 |
| 18105 | 1023 |
| 18106 | 1023 |
| 18107 | 1023 |
| 18108 | 1023 |
| 18109 | 1023 |
| 18110 | 1023 |
| 18111 | 1023 |
| 18112 | 1023 |
| 18113 | 0 |
| 18114 | 0 |
| 18115 | 0 |
| 18116 | 0 |
| 18117 | 0 |
| 18118 | 0 |
| 18119 | 0 |
| 18120 | 0 |
| 18121 | 0 |
| 18122 | 0 |
| 18123 | 0 |
| 18124 | 0 |
| 18125 | 0 |
| 18126 | 0 |
| 18127 | 0 |
| 18128 | 1023 |
| 18129 | 1023 |
| 18130 | 1023 |
| 18131 | 1023 |
| 18132 | 1023 |
| 18133 | 1023 |
| 18134 | 1023 |
| 18135 | 1023 |
| 18136 | 1023 |
| 18137 | 1023 |
| 18138 | 1023 |
| 18139 | 1023 |
| 18140 | 1023 |
| 18141 | 1023 |
| 18142 | 1023 |
| 18143 | 1023 |
| 18144 | 1023 |
| 18145 | 1023 |
| 18146 | 1023 |
| 18147 | 1023 |
| 18148 | 1023 |
| 18149 | 1023 |
| 18150 | 1023 |
| 18151 | 1023 |
| 18152 | 1023 |
| 18153 | 1023 |
| 18154 | 1023 |
| 18155 | 1023 |
| 18156 | 1023 |
| 18157 | 1023 |
| 18158 | 1023 |
| 18159 | 1023 |
| 18160 | 1023 |
| 18161 | 1023 |
| 18162 | 1023 |
| 18163 | 1023 |
| 18164 | 1023 |
| 18165 | 0 |
| 18166 | 0 |
| 18167 | 0 |
| 18168 | 0 |
| 18169 | 0 |
| 18170 | 0 |
| 18171 | 0 |
| 18172 | 0 |
| 18173 | 0 |
| 18174 | 0 |
| 18175 | 0 |
| 18176 | 0 |
| 18177 | 0 |
| 18178 | 0 |
| 18179 | 0 |
| 18180 | 1023 |
| 18181 | 1023 |
| 18182 | 1023 |
| 18183 | 1023 |
| 18184 | 1023 |
| 18185 | 1023 |
| 18186 | 1023 |
| 18187 | 1023 |
| 18188 | 1023 |
| 18189 | 1023 |
| 18190 | 1023 |
| 18191 | 1023 |
| 18192 | 1023 |
| 18193 | 1023 |
| 18194 | 1023 |
| 18195 | 1023 |
| 18196 | 1023 |
| 18197 | 1023 |
| 18198 | 1023 |
| 18199 | 1023 |
| 18200 | 1023 |
| 18201 | 1023 |
| 18202 | 1023 |
| 18203 | 1023 |
| 18204 | 1023 |
| 18205 | 1023 |
| 18206 | 1023 |
| 18207 | 1023 |
| 18208 | 1023 |
| 18209 | 1023 |
| 18210 | 1023 |
| 18211 | 1023 |
| 18212 | 1023 |
| 18213 | 1023 |
| 18214 | 1023 |
| 18215 | 1023 |
| 18216 | 1023 |
| 18217 | 0 |
| 18218 | 0 |
| 18219 | 0 |
| 18220 | 0 |
| 18221 | 0 |
| 18222 | 0 |
| 18223 | 0 |
| 18224 | 0 |
| 18225 | 0 |
| 18226 | 0 |
| 18227 | 0 |
| 18228 | 0 |
| 18229 | 1 |
| 18230 | 1 |
| 18231 | 0 |
| 18232 | 1023 |
| 18233 | 1023 |
| 18234 | 1023 |
| 18235 | 1023 |
| 18236 | 1023 |
| 18237 | 1023 |
| 18238 | 1023 |
| 18239 | 1023 |
| 18240 | 1023 |
| 18241 | 1023 |
| 18242 | 1023 |
| 18243 | 1023 |
| 18244 | 1023 |
| 18245 | 1023 |
| 18246 | 1023 |
| 18247 | 1023 |
| 18248 | 1023 |
| 18249 | 1023 |
| 18250 | 1023 |
| 18251 | 1023 |
| 18252 | 1023 |
| 18253 | 1023 |
| 18254 | 1023 |
| 18255 | 1023 |
| 18256 | 1023 |
| 18257 | 1023 |
| 18258 | 1023 |
| 18259 | 1023 |
| 18260 | 1023 |
| 18261 | 1023 |
| 18262 | 1023 |
| 18263 | 1023 |
| 18264 | 1023 |
| 18265 | 1023 |
| 18266 | 1023 |
| 18267 | 1023 |
| 18268 | 1023 |
| 18269 | 0 |
| 18270 | 0 |
| 18271 | 0 |
| 18272 | 0 |
| 18273 | 0 |
| 18274 | 0 |
| 18275 | 0 |
| 18276 | 0 |
| 18277 | 0 |
| 18278 | 0 |
| 18279 | 0 |
| 18280 | 0 |
| 18281 | 0 |
| 18282 | 0 |
| 18283 | 0 |
| 18284 | 1023 |
| 18285 | 1023 |
| 18286 | 1023 |
| 18287 | 1023 |
| 18288 | 1023 |
| 18289 | 1023 |
| 18290 | 1023 |
| 18291 | 1023 |
| 18292 | 1023 |
| 18293 | 1023 |
| 18294 | 1023 |
| 18295 | 1023 |
| 18296 | 1023 |
| 18297 | 1023 |
| 18298 | 1023 |
| 18299 | 1023 |
| 18300 | 1023 |
| 18301 | 1023 |
| 18302 | 1023 |
| 18303 | 1023 |
| 18304 | 1023 |
| 18305 | 1023 |
| 18306 | 1023 |
| 18307 | 1023 |
| 18308 | 1023 |
| 18309 | 1023 |
| 18310 | 1023 |
| 18311 | 1023 |
| 18312 | 1023 |
| 18313 | 1023 |
| 18314 | 1023 |
| 18315 | 1023 |
| 18316 | 1023 |
| 18317 | 1023 |
| 18318 | 1023 |
| 18319 | 1023 |
| 18320 | 1023 |
| 18321 | 50 |
| 18322 | 0 |
| 18323 | 0 |
| 18324 | 0 |
| 18325 | 0 |
| 18326 | 0 |
| 18327 | 0 |
| 18328 | 0 |
| 18329 | 0 |
| 18330 | 0 |
| 18331 | 0 |
| 18332 | 0 |
| 18333 | 0 |
| 18334 | 0 |
| 18335 | 1023 |
| 18336 | 1023 |
| 18337 | 1023 |
| 18338 | 1023 |
| 18339 | 1023 |
| 18340 | 1023 |
| 18341 | 1023 |
| 18342 | 1023 |
| 18343 | 1023 |
| 18344 | 1023 |
| 18345 | 1023 |
| 18346 | 1023 |
| 18347 | 1023 |
| 18348 | 1023 |
| 18349 | 1023 |
| 18350 | 1023 |
| 18351 | 1023 |
| 18352 | 1023 |
| 18353 | 1023 |
| 18354 | 1023 |
| 18355 | 1023 |
| 18356 | 1023 |
| 18357 | 1023 |
| 18358 | 1023 |
| 18359 | 1023 |
| 18360 | 1023 |
| 18361 | 1023 |
| 18362 | 1023 |
| 18363 | 1023 |
| 18364 | 1023 |
| 18365 | 1023 |
| 18366 | 1023 |
| 18367 | 1023 |
| 18368 | 1023 |
| 18369 | 1023 |
| 18370 | 1023 |
| 18371 | 1023 |
| 18372 | 1023 |
| 18373 | 0 |
| 18374 | 0 |
| 18375 | 0 |
| 18376 | 0 |
| 18377 | 0 |
| 18378 | 0 |
| 18379 | 0 |
| 18380 | 0 |
| 18381 | 0 |
| 18382 | 0 |
| 18383 | 0 |
| 18384 | 0 |
| 18385 | 0 |
| 18386 | 0 |
| 18387 | 1023 |
| 18388 | 1023 |
| 18389 | 1023 |
| 18390 | 1023 |
| 18391 | 1023 |
| 18392 | 1023 |
| 18393 | 1023 |
| 18394 | 1023 |
| 18395 | 1023 |
| 18396 | 1023 |
| 18397 | 1023 |
| 18398 | 1023 |
| 18399 | 1023 |
| 18400 | 1023 |
| 18401 | 1023 |
| 18402 | 1023 |
| 18403 | 1023 |
| 18404 | 1023 |
| 18405 | 1023 |
| 18406 | 1023 |
| 18407 | 1023 |
| 18408 | 1023 |
| 18409 | 1023 |
| 18410 | 1023 |
| 18411 | 1023 |
| 18412 | 1023 |
| 18413 | 1023 |
| 18414 | 1023 |
| 18415 | 1023 |
| 18416 | 1023 |
| 18417 | 1023 |
| 18418 | 1023 |
| 18419 | 1023 |
| 18420 | 1023 |
| 18421 | 1023 |
| 18422 | 1023 |
| 18423 | 1023 |
| 18424 | 0 |
| 18425 | 0 |
| 18426 | 0 |
| 18427 | 0 |
| 18428 | 0 |
| 18429 | 0 |
| 18430 | 0 |
| 18431 | 0 |
| 18432 | 0 |
| 18433 | 0 |
| 18434 | 0 |
| 18435 | 0 |
| 18436 | 0 |
| 18437 | 0 |
| 18438 | 0 |
| 18439 | 1023 |
| 18440 | 1023 |
| 18441 | 1023 |
| 18442 | 1023 |
| 18443 | 1023 |
| 18444 | 1023 |
| 18445 | 1023 |
| 18446 | 1023 |
| 18447 | 1023 |
| 18448 | 1023 |
| 18449 | 1023 |
| 18450 | 1023 |
| 18451 | 1023 |
| 18452 | 1023 |
| 18453 | 1023 |
| 18454 | 1023 |
| 18455 | 1023 |
| 18456 | 1023 |
| 18457 | 1023 |
| 18458 | 1023 |
| 18459 | 1023 |
| 18460 | 1023 |
| 18461 | 1023 |
| 18462 | 1023 |
| 18463 | 1023 |
| 18464 | 1023 |
| 18465 | 1023 |
| 18466 | 1023 |
| 18467 | 1023 |
| 18468 | 1023 |
| 18469 | 1023 |
| 18470 | 1023 |
| 18471 | 1023 |
| 18472 | 1023 |
| 18473 | 1023 |
| 18474 | 1023 |
| 18475 | 1023 |
| 18476 | 0 |
| 18477 | 0 |
| 18478 | 0 |
| 18479 | 0 |
| 18480 | 0 |
| 18481 | 0 |
| 18482 | 0 |
| 18483 | 0 |
| 18484 | 0 |
| 18485 | 0 |
| 18486 | 0 |
| 18487 | 0 |
| 18488 | 0 |
| 18489 | 0 |
| 18490 | 0 |
| 18491 | 1023 |
| 18492 | 1023 |
| 18493 | 1023 |
| 18494 | 1023 |
| 18495 | 1023 |
| 18496 | 1023 |
| 18497 | 1023 |
| 18498 | 1023 |
| 18499 | 1023 |
| 18500 | 1023 |
| 18501 | 1023 |
| 18502 | 1023 |
| 18503 | 1023 |
| 18504 | 1023 |
| 18505 | 1023 |
| 18506 | 1023 |
| 18507 | 1023 |
| 18508 | 1023 |
| 18509 | 1023 |
| 18510 | 1023 |
| 18511 | 1023 |
| 18512 | 1023 |
| 18513 | 1023 |
| 18514 | 1023 |
| 18515 | 1023 |
| 18516 | 1023 |
| 18517 | 1023 |
| 18518 | 1023 |
| 18519 | 1023 |
| 18520 | 1023 |
| 18521 | 1023 |
| 18522 | 1023 |
| 18523 | 1023 |
| 18524 | 1023 |
| 18525 | 1023 |
| 18526 | 1023 |
| 18527 | 1023 |
| 18528 | 1023 |
| 18529 | 0 |
| 18530 | 0 |
| 18531 | 0 |
| 18532 | 0 |
| 18533 | 0 |
| 18534 | 0 |
| 18535 | 0 |
| 18536 | 0 |
| 18537 | 0 |
| 18538 | 0 |
| 18539 | 0 |
| 18540 | 0 |
| 18541 | 0 |
| 18542 | 1023 |
| 18543 | 1023 |
| 18544 | 1023 |
| 18545 | 1023 |
| 18546 | 1023 |
| 18547 | 1023 |
| 18548 | 1023 |
| 18549 | 1023 |
| 18550 | 1023 |
| 18551 | 1023 |
| 18552 | 1023 |
| 18553 | 1023 |
| 18554 | 1023 |
| 18555 | 1023 |
| 18556 | 1023 |
| 18557 | 1023 |
| 18558 | 1023 |
| 18559 | 1023 |
| 18560 | 1023 |
| 18561 | 1023 |
| 18562 | 1023 |
| 18563 | 1023 |
| 18564 | 1023 |
| 18565 | 1023 |
| 18566 | 1023 |
| 18567 | 1023 |
| 18568 | 1023 |
| 18569 | 1023 |
| 18570 | 1023 |
| 18571 | 1023 |
| 18572 | 1023 |
| 18573 | 1023 |
| 18574 | 1023 |
| 18575 | 1023 |
| 18576 | 1023 |
| 18577 | 1023 |
| 18578 | 1023 |
| 18579 | 1023 |
| 18580 | 0 |
| 18581 | 0 |
| 18582 | 0 |
| 18583 | 0 |
| 18584 | 0 |
| 18585 | 0 |
| 18586 | 0 |
| 18587 | 0 |
| 18588 | 0 |
| 18589 | 0 |
| 18590 | 0 |
| 18591 | 0 |
| 18592 | 0 |
| 18593 | 1023 |
| 18594 | 1023 |
| 18595 | 1023 |
| 18596 | 1023 |
| 18597 | 1023 |
| 18598 | 1023 |
| 18599 | 1023 |
| 18600 | 1023 |
| 18601 | 1023 |
| 18602 | 1023 |
| 18603 | 1023 |
| 18604 | 1023 |
| 18605 | 1023 |
| 18606 | 1023 |
| 18607 | 1023 |
| 18608 | 1023 |
| 18609 | 1023 |
| 18610 | 1023 |
| 18611 | 1023 |
| 18612 | 1023 |
| 18613 | 1023 |
| 18614 | 1023 |
| 18615 | 1023 |
| 18616 | 1023 |
| 18617 | 1023 |
| 18618 | 1023 |
| 18619 | 1023 |
| 18620 | 1023 |
| 18621 | 1023 |
| 18622 | 1023 |
| 18623 | 1023 |
| 18624 | 1023 |
| 18625 | 1023 |
| 18626 | 1023 |
| 18627 | 1023 |
| 18628 | 1023 |
| 18629 | 1023 |
| 18630 | 1023 |
| 18631 | 0 |
| 18632 | 0 |
| 18633 | 0 |
| 18634 | 0 |
| 18635 | 0 |
| 18636 | 0 |
| 18637 | 0 |
| 18638 | 0 |
| 18639 | 0 |
| 18640 | 0 |
| 18641 | 0 |
| 18642 | 0 |
| 18643 | 0 |
| 18644 | 1023 |
| 18645 | 1023 |
| 18646 | 1023 |
| 18647 | 1023 |
| 18648 | 1023 |
| 18649 | 1023 |
| 18650 | 1023 |
| 18651 | 1023 |
| 18652 | 1023 |
| 18653 | 1023 |
| 18654 | 1023 |
| 18655 | 1023 |
| 18656 | 1023 |
| 18657 | 1023 |
| 18658 | 1023 |
| 18659 | 1023 |
| 18660 | 1023 |
| 18661 | 1023 |
| 18662 | 1023 |
| 18663 | 1023 |
| 18664 | 1023 |
| 18665 | 1023 |
| 18666 | 1023 |
| 18667 | 1023 |
| 18668 | 1023 |
| 18669 | 1023 |
| 18670 | 1023 |
| 18671 | 1023 |
| 18672 | 1023 |
| 18673 | 1023 |
| 18674 | 1023 |
| 18675 | 1023 |
| 18676 | 1023 |
| 18677 | 1023 |
| 18678 | 1023 |
| 18679 | 1023 |
| 18680 | 1023 |
| 18681 | 1023 |
| 18682 | 0 |
| 18683 | 0 |
| 18684 | 0 |
| 18685 | 0 |
| 18686 | 0 |
| 18687 | 0 |
| 18688 | 0 |
| 18689 | 0 |
| 18690 | 0 |
| 18691 | 0 |
| 18692 | 0 |
| 18693 | 0 |
| 18694 | 0 |
| 18695 | 1023 |
| 18696 | 1023 |
| 18697 | 1023 |
| 18698 | 1023 |
| 18699 | 1023 |
| 18700 | 1023 |
| 18701 | 1023 |
| 18702 | 1023 |
| 18703 | 1023 |
| 18704 | 1023 |
| 18705 | 1023 |
| 18706 | 1023 |
| 18707 | 1023 |
| 18708 | 1023 |
| 18709 | 1023 |
| 18710 | 1023 |
| 18711 | 1023 |
| 18712 | 1023 |
| 18713 | 1023 |
| 18714 | 1023 |
| 18715 | 1023 |
| 18716 | 1023 |
| 18717 | 1023 |
| 18718 | 1023 |
| 18719 | 1023 |
| 18720 | 1023 |
| 18721 | 1023 |
| 18722 | 1023 |
| 18723 | 1023 |
| 18724 | 1023 |
| 18725 | 1023 |
| 18726 | 1023 |
| 18727 | 1023 |
| 18728 | 1023 |
| 18729 | 1023 |
| 18730 | 1023 |
| 18731 | 1023 |
| 18732 | 1023 |
| 18733 | 0 |
| 18734 | 0 |
| 18735 | 0 |
| 18736 | 0 |
| 18737 | 0 |
| 18738 | 0 |
| 18739 | 0 |
| 18740 | 0 |
| 18741 | 0 |
| 18742 | 0 |
| 18743 | 0 |
| 18744 | 0 |
| 18745 | 0 |
| 18746 | 1023 |
| 18747 | 1023 |
| 18748 | 1023 |
| 18749 | 1023 |
| 18750 | 1023 |
| 18751 | 1023 |
| 18752 | 1023 |
| 18753 | 1023 |
| 18754 | 1023 |
| 18755 | 1023 |
| 18756 | 1023 |
| 18757 | 1023 |
| 18758 | 1023 |
| 18759 | 1023 |
| 18760 | 1023 |
| 18761 | 1023 |
| 18762 | 1023 |
| 18763 | 1023 |
| 18764 | 1023 |
| 18765 | 1023 |
| 18766 | 1023 |
| 18767 | 1023 |
| 18768 | 1023 |
| 18769 | 1023 |
| 18770 | 1023 |
| 18771 | 1023 |
| 18772 | 1023 |
| 18773 | 1023 |
| 18774 | 1023 |
| 18775 | 1023 |
| 18776 | 1023 |
| 18777 | 1023 |
| 18778 | 1023 |
| 18779 | 1023 |
| 18780 | 1023 |
| 18781 | 1023 |
| 18782 | 1023 |
| 18783 | 1023 |
| 18784 | 0 |
| 18785 | 0 |
| 18786 | 0 |
| 18787 | 0 |
| 18788 | 0 |
| 18789 | 0 |
| 18790 | 0 |
| 18791 | 0 |
| 18792 | 0 |
| 18793 | 0 |
| 18794 | 0 |
| 18795 | 0 |
| 18796 | 0 |
| 18797 | 1023 |
| 18798 | 1023 |
| 18799 | 1023 |
| 18800 | 1023 |
| 18801 | 1023 |
| 18802 | 1023 |
| 18803 | 1023 |
| 18804 | 1023 |
| 18805 | 1023 |
| 18806 | 1023 |
| 18807 | 1023 |
| 18808 | 1023 |
| 18809 | 1023 |
| 18810 | 1023 |
| 18811 | 1023 |
| 18812 | 1023 |
| 18813 | 1023 |
| 18814 | 1023 |
| 18815 | 1023 |
| 18816 | 1023 |
| 18817 | 1023 |
| 18818 | 1023 |
| 18819 | 1023 |
| 18820 | 1023 |
| 18821 | 1023 |
| 18822 | 1023 |
| 18823 | 1023 |
| 18824 | 1023 |
| 18825 | 1023 |
| 18826 | 1023 |
| 18827 | 1023 |
| 18828 | 1023 |
| 18829 | 1023 |
| 18830 | 1023 |
| 18831 | 1023 |
| 18832 | 1023 |
| 18833 | 1023 |
| 18834 | 1023 |
| 18835 | 0 |
| 18836 | 0 |
| 18837 | 0 |
| 18838 | 0 |
| 18839 | 0 |
| 18840 | 0 |
| 18841 | 0 |
| 18842 | 0 |
| 18843 | 0 |
| 18844 | 0 |
| 18845 | 0 |
| 18846 | 0 |
| 18847 | 0 |
| 18848 | 851 |
| 18849 | 1023 |
| 18850 | 1023 |
| 18851 | 1023 |
| 18852 | 1023 |
| 18853 | 1023 |
| 18854 | 1023 |
| 18855 | 1023 |
| 18856 | 1023 |
| 18857 | 1023 |
| 18858 | 1023 |
| 18859 | 1023 |
| 18860 | 1023 |
| 18861 | 1023 |
| 18862 | 1023 |
| 18863 | 1023 |
| 18864 | 1023 |
| 18865 | 1023 |
| 18866 | 1023 |
| 18867 | 1023 |
| 18868 | 1023 |
| 18869 | 1023 |
| 18870 | 1023 |
| 18871 | 1023 |
| 18872 | 1023 |
| 18873 | 1023 |
| 18874 | 1023 |
| 18875 | 1023 |
| 18876 | 1023 |
| 18877 | 1023 |
| 18878 | 1023 |
| 18879 | 1023 |
| 18880 | 1023 |
| 18881 | 1023 |
| 18882 | 1023 |
| 18883 | 1023 |
| 18884 | 1023 |
| 18885 | 1023 |
| 18886 | 0 |
| 18887 | 0 |
| 18888 | 0 |
| 18889 | 0 |
| 18890 | 0 |
| 18891 | 0 |
| 18892 | 0 |
| 18893 | 0 |
| 18894 | 0 |
| 18895 | 0 |
| 18896 | 0 |
| 18897 | 0 |
| 18898 | 0 |
| 18899 | 0 |
| 18900 | 1023 |
| 18901 | 1023 |
| 18902 | 1023 |
| 18903 | 1023 |
| 18904 | 1023 |
| 18905 | 1023 |
| 18906 | 1023 |
| 18907 | 1023 |
| 18908 | 1023 |
| 18909 | 1023 |
| 18910 | 1023 |
| 18911 | 1023 |
| 18912 | 1023 |
| 18913 | 1023 |
| 18914 | 1023 |
| 18915 | 1023 |
| 18916 | 1023 |
| 18917 | 1023 |
| 18918 | 1023 |
| 18919 | 1023 |
| 18920 | 1023 |
| 18921 | 1023 |
| 18922 | 1023 |
| 18923 | 1023 |
| 18924 | 1023 |
| 18925 | 1023 |
| 18926 | 1023 |
| 18927 | 1023 |
| 18928 | 1023 |
| 18929 | 1023 |
| 18930 | 1023 |
| 18931 | 1023 |
| 18932 | 1023 |
| 18933 | 1023 |
| 18934 | 1023 |
| 18935 | 1023 |
| 18936 | 1023 |
| 18937 | 1023 |
| 18938 | 0 |
| 18939 | 0 |
| 18940 | 0 |
| 18941 | 0 |
| 18942 | 0 |
| 18943 | 0 |
| 18944 | 0 |
| 18945 | 0 |
| 18946 | 0 |
| 18947 | 0 |
| 18948 | 0 |
| 18949 | 0 |
| 18950 | 0 |
| 18951 | 1023 |
| 18952 | 1023 |
| 18953 | 1023 |
| 18954 | 1023 |
| 18955 | 1023 |
| 18956 | 1023 |
| 18957 | 1023 |
| 18958 | 1023 |
| 18959 | 1023 |
| 18960 | 1023 |
| 18961 | 1023 |
| 18962 | 1023 |
| 18963 | 1023 |
| 18964 | 1023 |
| 18965 | 1023 |
| 18966 | 1023 |
| 18967 | 1023 |
| 18968 | 1023 |
| 18969 | 1023 |
| 18970 | 1023 |
| 18971 | 1023 |
| 18972 | 1023 |
| 18973 | 1023 |
| 18974 | 1023 |
| 18975 | 1023 |
| 18976 | 1023 |
| 18977 | 1023 |
| 18978 | 1023 |
| 18979 | 1023 |
| 18980 | 1023 |
| 18981 | 1023 |
| 18982 | 1023 |
| 18983 | 1023 |
| 18984 | 1023 |
| 18985 | 1023 |
| 18986 | 1023 |
| 18987 | 1023 |
| 18988 | 1023 |
| 18989 | 0 |
| 18990 | 0 |
| 18991 | 0 |
| 18992 | 0 |
| 18993 | 0 |
| 18994 | 0 |
| 18995 | 0 |
| 18996 | 0 |
| 18997 | 0 |
| 18998 | 0 |
| 18999 | 0 |
| 19000 | 0 |
| 19001 | 1 |
| 19002 | 1023 |
| 19003 | 1023 |
| 19004 | 1023 |
| 19005 | 1023 |
| 19006 | 1023 |
| 19007 | 1023 |
| 19008 | 1023 |
| 19009 | 1023 |
| 19010 | 1023 |
| 19011 | 1023 |
| 19012 | 1023 |
| 19013 | 1023 |
| 19014 | 1023 |
| 19015 | 1023 |
| 19016 | 1023 |
| 19017 | 1023 |
| 19018 | 1023 |
| 19019 | 1023 |
| 19020 | 1023 |
| 19021 | 1023 |
| 19022 | 1023 |
| 19023 | 1023 |
| 19024 | 1023 |
| 19025 | 1023 |
| 19026 | 1023 |
| 19027 | 1023 |
| 19028 | 1023 |
| 19029 | 1023 |
| 19030 | 1023 |
| 19031 | 1023 |
| 19032 | 1023 |
| 19033 | 1023 |
| 19034 | 1023 |
| 19035 | 1023 |
| 19036 | 1023 |
| 19037 | 1023 |
| 19038 | 1023 |
| 19039 | 1023 |
| 19040 | 0 |
| 19041 | 0 |
| 19042 | 0 |
| 19043 | 0 |
| 19044 | 0 |
| 19045 | 0 |
| 19046 | 0 |
| 19047 | 0 |
| 19048 | 0 |
| 19049 | 0 |
| 19050 | 0 |
| 19051 | 0 |
| 19052 | 0 |
| 19053 | 1023 |
| 19054 | 1023 |
| 19055 | 1023 |
| 19056 | 1023 |
| 19057 | 1023 |
| 19058 | 1023 |
| 19059 | 1023 |
| 19060 | 1023 |
| 19061 | 1023 |
| 19062 | 1023 |
| 19063 | 1023 |
| 19064 | 1023 |
| 19065 | 1023 |
| 19066 | 1023 |
| 19067 | 1023 |
| 19068 | 1023 |
| 19069 | 1023 |
| 19070 | 1023 |
| 19071 | 1023 |
| 19072 | 1023 |
| 19073 | 1023 |
| 19074 | 1023 |
| 19075 | 1023 |
| 19076 | 1023 |
| 19077 | 1023 |
| 19078 | 1023 |
| 19079 | 1023 |
| 19080 | 1023 |
| 19081 | 1023 |
| 19082 | 1023 |
| 19083 | 1023 |
| 19084 | 1023 |
| 19085 | 1023 |
| 19086 | 1023 |
| 19087 | 1023 |
| 19088 | 1023 |
| 19089 | 1023 |
| 19090 | 1023 |
| 19091 | 0 |
| 19092 | 0 |
| 19093 | 0 |
| 19094 | 0 |
| 19095 | 0 |
| 19096 | 0 |
| 19097 | 0 |
| 19098 | 0 |
| 19099 | 0 |
| 19100 | 0 |
| 19101 | 0 |
| 19102 | 0 |
| 19103 | 0 |
| 19104 | 1023 |
| 19105 | 1023 |
| 19106 | 1023 |
| 19107 | 1023 |
| 19108 | 1023 |
| 19109 | 1023 |
| 19110 | 1023 |
| 19111 | 1023 |
| 19112 | 1023 |
| 19113 | 1023 |
| 19114 | 1023 |
| 19115 | 1023 |
| 19116 | 1023 |
| 19117 | 1023 |
| 19118 | 1023 |
| 19119 | 1023 |
| 19120 | 1023 |
| 19121 | 1023 |
| 19122 | 1023 |
| 19123 | 1023 |
| 19124 | 1023 |
| 19125 | 1023 |
| 19126 | 1023 |
| 19127 | 1023 |
| 19128 | 1023 |
| 19129 | 1023 |
| 19130 | 1023 |
| 19131 | 1023 |
| 19132 | 1023 |
| 19133 | 1023 |
| 19134 | 1023 |
| 19135 | 1023 |
| 19136 | 1023 |
| 19137 | 1023 |
| 19138 | 1023 |
| 19139 | 1023 |
| 19140 | 1023 |
| 19141 | 1023 |
| 19142 | 0 |
| 19143 | 0 |
| 19144 | 0 |
| 19145 | 0 |
| 19146 | 0 |
| 19147 | 0 |
| 19148 | 0 |
| 19149 | 1 |
| 19150 | 0 |
| 19151 | 0 |
| 19152 | 0 |
| 19153 | 0 |
| 19154 | 0 |
| 19155 | 1023 |
| 19156 | 1023 |
| 19157 | 1023 |
| 19158 | 1023 |
| 19159 | 1023 |
| 19160 | 1023 |
| 19161 | 1023 |
| 19162 | 1023 |
| 19163 | 1023 |
| 19164 | 1023 |
| 19165 | 1023 |
| 19166 | 1023 |
| 19167 | 1023 |
| 19168 | 1023 |
| 19169 | 1023 |
| 19170 | 1023 |
| 19171 | 1023 |
| 19172 | 1023 |
| 19173 | 1023 |
| 19174 | 1023 |
| 19175 | 1023 |
| 19176 | 1023 |
| 19177 | 1023 |
| 19178 | 1023 |
| 19179 | 1023 |
| 19180 | 1023 |
| 19181 | 1023 |
| 19182 | 1023 |
| 19183 | 1023 |
| 19184 | 1023 |
| 19185 | 1023 |
| 19186 | 1023 |
| 19187 | 1023 |
| 19188 | 1023 |
| 19189 | 1023 |
| 19190 | 1023 |
| 19191 | 1023 |
| 19192 | 1023 |
| 19193 | 0 |
| 19194 | 0 |
| 19195 | 0 |
| 19196 | 0 |
| 19197 | 0 |
| 19198 | 0 |
| 19199 | 0 |
| 19200 | 0 |
| 19201 | 0 |
| 19202 | 0 |
| 19203 | 1 |
| 19204 | 1 |
| 19205 | 1 |
| 19206 | 1023 |
| 19207 | 1023 |
| 19208 | 1023 |
| 19209 | 1023 |
| 19210 | 1023 |
| 19211 | 1023 |
| 19212 | 1023 |
| 19213 | 1023 |
| 19214 | 1023 |
| 19215 | 1023 |
| 19216 | 1023 |
| 19217 | 1023 |
| 19218 | 1023 |
| 19219 | 1023 |
| 19220 | 1023 |
| 19221 | 1023 |
| 19222 | 1023 |
| 19223 | 1023 |
| 19224 | 1023 |
| 19225 | 1023 |
| 19226 | 1023 |
| 19227 | 1023 |
| 19228 | 1023 |
| 19229 | 1023 |
| 19230 | 1023 |
| 19231 | 1023 |
| 19232 | 1023 |
| 19233 | 1023 |
| 19234 | 1023 |
| 19235 | 1023 |
| 19236 | 1023 |
| 19237 | 1023 |
| 19238 | 1023 |
| 19239 | 1023 |
| 19240 | 1023 |
| 19241 | 1023 |
| 19242 | 1023 |
| 19243 | 1023 |
| 19244 | 0 |
| 19245 | 0 |
| 19246 | 0 |
| 19247 | 0 |
| 19248 | 0 |
| 19249 | 0 |
| 19250 | 0 |
| 19251 | 0 |
| 19252 | 0 |
| 19253 | 0 |
| 19254 | 0 |
| 19255 | 0 |
| 19256 | 0 |
| 19257 | 1023 |
| 19258 | 1023 |
| 19259 | 1023 |
| 19260 | 1023 |
| 19261 | 1023 |
| 19262 | 1023 |
| 19263 | 1023 |
| 19264 | 1023 |
| 19265 | 1023 |
| 19266 | 1023 |
| 19267 | 1023 |
| 19268 | 1023 |
| 19269 | 1023 |
| 19270 | 1023 |
| 19271 | 1023 |
| 19272 | 1023 |
| 19273 | 1023 |
| 19274 | 1023 |
| 19275 | 1023 |
| 19276 | 1023 |
| 19277 | 1023 |
| 19278 | 1023 |
| 19279 | 1023 |
| 19280 | 1023 |
| 19281 | 1023 |
| 19282 | 1023 |
| 19283 | 1023 |
| 19284 | 1023 |
| 19285 | 1023 |
| 19286 | 1023 |
| 19287 | 1023 |
| 19288 | 1023 |
| 19289 | 1023 |
| 19290 | 1023 |
| 19291 | 1023 |
| 19292 | 1023 |
| 19293 | 1023 |
| 19294 | 1023 |
| 19295 | 0 |
| 19296 | 0 |
| 19297 | 0 |
| 19298 | 0 |
| 19299 | 0 |
| 19300 | 0 |
| 19301 | 0 |
| 19302 | 0 |
| 19303 | 0 |
| 19304 | 0 |
| 19305 | 0 |
| 19306 | 0 |
| 19307 | 0 |
| 19308 | 1023 |
| 19309 | 1023 |
| 19310 | 1023 |
| 19311 | 1023 |
| 19312 | 1023 |
| 19313 | 1023 |
| 19314 | 1023 |
| 19315 | 1023 |
| 19316 | 1023 |
| 19317 | 1023 |
| 19318 | 1023 |
| 19319 | 1023 |
| 19320 | 1023 |
| 19321 | 1023 |
| 19322 | 1023 |
| 19323 | 1023 |
| 19324 | 1023 |
| 19325 | 1023 |
| 19326 | 1023 |
| 19327 | 1023 |
| 19328 | 1023 |
| 19329 | 1023 |
| 19330 | 1023 |
| 19331 | 1023 |
| 19332 | 1023 |
| 19333 | 1023 |
| 19334 | 1023 |
| 19335 | 1023 |
| 19336 | 1023 |
| 19337 | 1023 |
| 19338 | 1023 |
| 19339 | 1023 |
| 19340 | 1023 |
| 19341 | 1023 |
| 19342 | 1023 |
| 19343 | 1023 |
| 19344 | 1023 |
| 19345 | 1023 |
| 19346 | 0 |
| 19347 | 0 |
| 19348 | 0 |
| 19349 | 0 |
| 19350 | 0 |
| 19351 | 0 |
| 19352 | 0 |
| 19353 | 0 |
| 19354 | 0 |
| 19355 | 0 |
| 19356 | 0 |
| 19357 | 0 |
| 19358 | 0 |
| 19359 | 0 |
| 19360 | 1023 |
| 19361 | 1023 |
| 19362 | 1023 |
| 19363 | 1023 |
| 19364 | 1023 |
| 19365 | 1023 |
| 19366 | 1023 |
| 19367 | 1023 |
| 19368 | 1023 |
| 19369 | 1023 |
| 19370 | 1023 |
| 19371 | 1023 |
| 19372 | 1023 |
| 19373 | 1023 |
| 19374 | 1023 |
| 19375 | 1023 |
| 19376 | 1023 |
| 19377 | 1023 |
| 19378 | 1023 |
| 19379 | 1023 |
| 19380 | 1023 |
| 19381 | 1023 |
| 19382 | 1023 |
| 19383 | 1023 |
| 19384 | 1023 |
| 19385 | 1023 |
| 19386 | 1023 |
| 19387 | 1023 |
| 19388 | 1023 |
| 19389 | 1023 |
| 19390 | 1023 |
| 19391 | 1023 |
| 19392 | 1023 |
| 19393 | 1023 |
| 19394 | 1023 |
| 19395 | 1023 |
| 19396 | 1023 |
| 19397 | 0 |
| 19398 | 0 |
| 19399 | 0 |
| 19400 | 0 |
| 19401 | 0 |
| 19402 | 0 |
| 19403 | 0 |
| 19404 | 0 |
| 19405 | 0 |
| 19406 | 0 |
| 19407 | 0 |
| 19408 | 0 |
| 19409 | 0 |
| 19410 | 0 |
| 19411 | 1023 |
| 19412 | 1023 |
| 19413 | 1023 |
| 19414 | 1023 |
| 19415 | 1023 |
| 19416 | 1023 |
| 19417 | 1023 |
| 19418 | 1023 |
| 19419 | 1023 |
| 19420 | 1023 |
| 19421 | 1023 |
| 19422 | 1023 |
| 19423 | 1023 |
| 19424 | 1023 |
| 19425 | 1023 |
| 19426 | 1023 |
| 19427 | 1023 |
| 19428 | 1023 |
| 19429 | 1023 |
| 19430 | 1023 |
| 19431 | 1023 |
| 19432 | 1023 |
| 19433 | 1023 |
| 19434 | 1023 |
| 19435 | 1023 |
| 19436 | 1023 |
| 19437 | 1023 |
| 19438 | 1023 |
| 19439 | 1023 |
| 19440 | 1023 |
| 19441 | 1023 |
| 19442 | 1023 |
| 19443 | 1023 |
| 19444 | 1023 |
| 19445 | 1023 |
| 19446 | 1023 |
| 19447 | 1023 |
| 19448 | 1023 |
| 19449 | 0 |
| 19450 | 0 |
| 19451 | 0 |
| 19452 | 0 |
| 19453 | 0 |
| 19454 | 0 |
| 19455 | 0 |
| 19456 | 0 |
| 19457 | 0 |
| 19458 | 0 |
| 19459 | 0 |
| 19460 | 0 |
| 19461 | 0 |
| 19462 | 0 |
| 19463 | 1023 |
| 19464 | 1023 |
| 19465 | 1023 |
| 19466 | 1023 |
| 19467 | 1023 |
| 19468 | 1023 |
| 19469 | 1023 |
| 19470 | 1023 |
| 19471 | 1023 |
| 19472 | 1023 |
| 19473 | 1023 |
| 19474 | 1023 |
| 19475 | 1023 |
| 19476 | 1023 |
| 19477 | 1023 |
| 19478 | 1023 |
| 19479 | 1023 |
| 19480 | 1023 |
| 19481 | 1023 |
| 19482 | 1023 |
| 19483 | 1023 |
| 19484 | 1023 |
| 19485 | 1023 |
| 19486 | 1023 |
| 19487 | 1023 |
| 19488 | 1023 |
| 19489 | 1023 |
| 19490 | 1023 |
| 19491 | 1023 |
| 19492 | 1023 |
| 19493 | 1023 |
| 19494 | 1023 |
| 19495 | 1023 |
| 19496 | 1023 |
| 19497 | 1023 |
| 19498 | 1023 |
| 19499 | 1023 |
| 19500 | 0 |
| 19501 | 0 |
| 19502 | 0 |
| 19503 | 0 |
| 19504 | 0 |
| 19505 | 0 |
| 19506 | 0 |
| 19507 | 0 |
| 19508 | 0 |
| 19509 | 0 |
| 19510 | 0 |
| 19511 | 0 |
| 19512 | 0 |
| 19513 | 0 |
| 19514 | 0 |
| 19515 | 1023 |
| 19516 | 1023 |
| 19517 | 1023 |
| 19518 | 1023 |
| 19519 | 1023 |
| 19520 | 1023 |
| 19521 | 1023 |
| 19522 | 1023 |
| 19523 | 1023 |
| 19524 | 1023 |
| 19525 | 1023 |
| 19526 | 1023 |
| 19527 | 1023 |
| 19528 | 1023 |
| 19529 | 1023 |
| 19530 | 1023 |
| 19531 | 1023 |
| 19532 | 1023 |
| 19533 | 1023 |
| 19534 | 1023 |
| 19535 | 1023 |
| 19536 | 1023 |
| 19537 | 1023 |
| 19538 | 1023 |
| 19539 | 1023 |
| 19540 | 1023 |
| 19541 | 1023 |
| 19542 | 1023 |
| 19543 | 1023 |
| 19544 | 1023 |
| 19545 | 1023 |
| 19546 | 1023 |
| 19547 | 1023 |
| 19548 | 1023 |
| 19549 | 1023 |
| 19550 | 1023 |
| 19551 | 1023 |
| 19552 | 0 |
| 19553 | 0 |
| 19554 | 0 |
| 19555 | 0 |
| 19556 | 0 |
| 19557 | 0 |
| 19558 | 0 |
| 19559 | 0 |
| 19560 | 0 |
| 19561 | 0 |
| 19562 | 0 |
| 19563 | 0 |
| 19564 | 0 |
| 19565 | 0 |
| 19566 | 0 |
| 19567 | 1023 |
| 19568 | 1023 |
| 19569 | 1023 |
| 19570 | 1023 |
| 19571 | 1023 |
| 19572 | 1023 |
| 19573 | 1023 |
| 19574 | 1023 |
| 19575 | 1023 |
| 19576 | 1023 |
| 19577 | 1023 |
| 19578 | 1023 |
| 19579 | 1023 |
| 19580 | 1023 |
| 19581 | 1023 |
| 19582 | 1023 |
| 19583 | 1023 |
| 19584 | 1023 |
| 19585 | 1023 |
| 19586 | 1023 |
| 19587 | 1023 |
| 19588 | 1023 |
| 19589 | 1023 |
| 19590 | 1023 |
| 19591 | 1023 |
| 19592 | 1023 |
| 19593 | 1023 |
| 19594 | 1023 |
| 19595 | 1023 |
| 19596 | 1023 |
| 19597 | 1023 |
| 19598 | 1023 |
| 19599 | 1023 |
| 19600 | 1023 |
| 19601 | 1023 |
| 19602 | 1023 |
| 19603 | 1023 |
| 19604 | 1023 |
| 19605 | 0 |
| 19606 | 0 |
| 19607 | 0 |
| 19608 | 0 |
| 19609 | 0 |
| 19610 | 0 |
| 19611 | 0 |
| 19612 | 0 |
| 19613 | 0 |
| 19614 | 0 |
| 19615 | 0 |
| 19616 | 0 |
| 19617 | 0 |
| 19618 | 1023 |
| 19619 | 1023 |
| 19620 | 1023 |
| 19621 | 1023 |
| 19622 | 1023 |
| 19623 | 1023 |
| 19624 | 1023 |
| 19625 | 1023 |
| 19626 | 1023 |
| 19627 | 1023 |
| 19628 | 1023 |
| 19629 | 1023 |
| 19630 | 1023 |
| 19631 | 1023 |
| 19632 | 1023 |
| 19633 | 1023 |
| 19634 | 1023 |
| 19635 | 1023 |
| 19636 | 1023 |
| 19637 | 1023 |
| 19638 | 1023 |
| 19639 | 1023 |
| 19640 | 1023 |
| 19641 | 1023 |
| 19642 | 1023 |
| 19643 | 1023 |
| 19644 | 1023 |
| 19645 | 1023 |
| 19646 | 1023 |
| 19647 | 1023 |
| 19648 | 1023 |
| 19649 | 1023 |
| 19650 | 1023 |
| 19651 | 1023 |
| 19652 | 1023 |
| 19653 | 1023 |
| 19654 | 1023 |
| 19655 | 1023 |
| 19656 | 0 |
| 19657 | 0 |
| 19658 | 0 |
| 19659 | 0 |
| 19660 | 0 |
| 19661 | 0 |
| 19662 | 0 |
| 19663 | 0 |
| 19664 | 0 |
| 19665 | 0 |
| 19666 | 0 |
| 19667 | 0 |
| 19668 | 0 |
| 19669 | 1023 |
| 19670 | 1023 |
| 19671 | 1023 |
| 19672 | 1023 |
| 19673 | 1023 |
| 19674 | 1023 |
| 19675 | 1023 |
| 19676 | 1023 |
| 19677 | 1023 |
| 19678 | 1023 |
| 19679 | 1023 |
| 19680 | 1023 |
| 19681 | 1023 |
| 19682 | 1023 |
| 19683 | 1023 |
| 19684 | 1023 |
| 19685 | 1023 |
| 19686 | 1023 |
| 19687 | 1023 |
| 19688 | 1023 |
| 19689 | 1023 |
| 19690 | 1023 |
| 19691 | 1023 |
| 19692 | 1023 |
| 19693 | 1023 |
| 19694 | 1023 |
| 19695 | 1023 |
| 19696 | 1023 |
| 19697 | 1023 |
| 19698 | 1023 |
| 19699 | 1023 |
| 19700 | 1023 |
| 19701 | 1023 |
| 19702 | 1023 |
| 19703 | 1023 |
| 19704 | 1023 |
| 19705 | 1023 |
| 19706 | 1023 |
| 19707 | 2 |
| 19708 | 1 |
| 19709 | 0 |
| 19710 | 0 |
| 19711 | 0 |
| 19712 | 0 |
| 19713 | 0 |
| 19714 | 0 |
| 19715 | 0 |
| 19716 | 0 |
| 19717 | 0 |
| 19718 | 0 |
| 19719 | 0 |
| 19720 | 1023 |
| 19721 | 1023 |
| 19722 | 1023 |
| 19723 | 1023 |
| 19724 | 1023 |
| 19725 | 1023 |
| 19726 | 1023 |
| 19727 | 1023 |
| 19728 | 1023 |
| 19729 | 1023 |
| 19730 | 1023 |
| 19731 | 1023 |
| 19732 | 1023 |
| 19733 | 1023 |
| 19734 | 1023 |
| 19735 | 1023 |
| 19736 | 1023 |
| 19737 | 1023 |
| 19738 | 1023 |
| 19739 | 1023 |
| 19740 | 1023 |
| 19741 | 1023 |
| 19742 | 1023 |
| 19743 | 1023 |
| 19744 | 1023 |
| 19745 | 1023 |
| 19746 | 1023 |
| 19747 | 1023 |
| 19748 | 1023 |
| 19749 | 1023 |
| 19750 | 1023 |
| 19751 | 1023 |
| 19752 | 1023 |
| 19753 | 1023 |
| 19754 | 1023 |
| 19755 | 1023 |
| 19756 | 1023 |
| 19757 | 1023 |
| 19758 | 0 |
| 19759 | 0 |
| 19760 | 0 |
| 19761 | 0 |
| 19762 | 0 |
| 19763 | 0 |
| 19764 | 0 |
| 19765 | 0 |
| 19766 | 0 |
| 19767 | 0 |
| 19768 | 0 |
| 19769 | 0 |
| 19770 | 0 |
| 19771 | 1023 |
| 19772 | 1023 |
| 19773 | 1023 |
| 19774 | 1023 |
| 19775 | 1023 |
| 19776 | 1023 |
| 19777 | 1023 |
| 19778 | 1023 |
| 19779 | 1023 |
| 19780 | 1023 |
| 19781 | 1023 |
| 19782 | 1023 |
| 19783 | 1023 |
| 19784 | 1023 |
| 19785 | 1023 |
| 19786 | 1023 |
| 19787 | 1023 |
| 19788 | 1023 |
| 19789 | 1023 |
| 19790 | 1023 |
| 19791 | 1023 |
| 19792 | 1023 |
| 19793 | 1023 |
| 19794 | 1023 |
| 19795 | 1023 |
| 19796 | 1023 |
| 19797 | 1023 |
| 19798 | 1023 |
| 19799 | 1023 |
| 19800 | 1023 |
| 19801 | 1023 |
| 19802 | 1023 |
| 19803 | 1023 |
| 19804 | 1023 |
| 19805 | 1023 |
| 19806 | 1023 |
| 19807 | 1023 |
| 19808 | 1023 |
| 19809 | 0 |
| 19810 | 0 |
| 19811 | 0 |
| 19812 | 0 |
| 19813 | 0 |
| 19814 | 0 |
| 19815 | 0 |
| 19816 | 0 |
| 19817 | 0 |
| 19818 | 0 |
| 19819 | 0 |
| 19820 | 0 |
| 19821 | 0 |
| 19822 | 1023 |
| 19823 | 1023 |
| 19824 | 1023 |
| 19825 | 1023 |
| 19826 | 1023 |
| 19827 | 1023 |
| 19828 | 1023 |
| 19829 | 1023 |
| 19830 | 1023 |
| 19831 | 1023 |
| 19832 | 1023 |
| 19833 | 1023 |
| 19834 | 1023 |
| 19835 | 1023 |
| 19836 | 1023 |
| 19837 | 1023 |
| 19838 | 1023 |
| 19839 | 1023 |
| 19840 | 1023 |
| 19841 | 1023 |
| 19842 | 1023 |
| 19843 | 1023 |
| 19844 | 1023 |
| 19845 | 1023 |
| 19846 | 1023 |
| 19847 | 1023 |
| 19848 | 1023 |
| 19849 | 1023 |
| 19850 | 1023 |
| 19851 | 1023 |
| 19852 | 1023 |
| 19853 | 1023 |
| 19854 | 1023 |
| 19855 | 1023 |
| 19856 | 1023 |
| 19857 | 1023 |
| 19858 | 1023 |
| 19859 | 1023 |
| 19860 | 0 |
| 19861 | 0 |
| 19862 | 0 |
| 19863 | 0 |
| 19864 | 0 |
| 19865 | 0 |
| 19866 | 0 |
| 19867 | 0 |
| 19868 | 0 |
| 19869 | 0 |
| 19870 | 0 |
| 19871 | 0 |
| 19872 | 0 |
| 19873 | 0 |
| 19874 | 1023 |
| 19875 | 1023 |
| 19876 | 1023 |
| 19877 | 1023 |
| 19878 | 1023 |
| 19879 | 1023 |
| 19880 | 1023 |
| 19881 | 1023 |
| 19882 | 1023 |
| 19883 | 1023 |
| 19884 | 1023 |
| 19885 | 1023 |
| 19886 | 1023 |
| 19887 | 1023 |
| 19888 | 1023 |
| 19889 | 1023 |
| 19890 | 1023 |
| 19891 | 1023 |
| 19892 | 1023 |
| 19893 | 1023 |
| 19894 | 1023 |
| 19895 | 1023 |
| 19896 | 1023 |
| 19897 | 1023 |
| 19898 | 1023 |
| 19899 | 1023 |
| 19900 | 1023 |
| 19901 | 1023 |
| 19902 | 1023 |
| 19903 | 1023 |
| 19904 | 1023 |
| 19905 | 1023 |
| 19906 | 1023 |
| 19907 | 1023 |
| 19908 | 1023 |
| 19909 | 1023 |
| 19910 | 1023 |
| 19911 | 0 |
| 19912 | 0 |
| 19913 | 0 |
| 19914 | 0 |
| 19915 | 0 |
| 19916 | 0 |
| 19917 | 0 |
| 19918 | 0 |
| 19919 | 0 |
| 19920 | 0 |
| 19921 | 0 |
| 19922 | 0 |
| 19923 | 0 |
| 19924 | 0 |
| 19925 | 1023 |
| 19926 | 1023 |
| 19927 | 1023 |
| 19928 | 1023 |
| 19929 | 1023 |
| 19930 | 1023 |
| 19931 | 1023 |
| 19932 | 1023 |
| 19933 | 1023 |
| 19934 | 1023 |
| 19935 | 1023 |
| 19936 | 1023 |
| 19937 | 1023 |
| 19938 | 1023 |
| 19939 | 1023 |
| 19940 | 1023 |
| 19941 | 1023 |
| 19942 | 1023 |
| 19943 | 1023 |
| 19944 | 1023 |
| 19945 | 1023 |
| 19946 | 1023 |
| 19947 | 1023 |
| 19948 | 1023 |
| 19949 | 1023 |
| 19950 | 1023 |
| 19951 | 1023 |
| 19952 | 1023 |
| 19953 | 1023 |
| 19954 | 1023 |
| 19955 | 1023 |
| 19956 | 1023 |
| 19957 | 1023 |
| 19958 | 1023 |
| 19959 | 1023 |
| 19960 | 1023 |
| 19961 | 1023 |
| 19962 | 1023 |
| 19963 | 0 |
| 19964 | 0 |
| 19965 | 0 |
| 19966 | 0 |
| 19967 | 0 |
| 19968 | 0 |
| 19969 | 0 |
| 19970 | 0 |
| 19971 | 0 |
| 19972 | 0 |
| 19973 | 0 |
| 19974 | 0 |
| 19975 | 0 |
| 19976 | 0 |
| 19977 | 1023 |
| 19978 | 1023 |
| 19979 | 1023 |
| 19980 | 1023 |
| 19981 | 1023 |
| 19982 | 1023 |
| 19983 | 1023 |
| 19984 | 1023 |
| 19985 | 1023 |
| 19986 | 1023 |
| 19987 | 1023 |
| 19988 | 1023 |
| 19989 | 1023 |
| 19990 | 1023 |
| 19991 | 1023 |
| 19992 | 1023 |
| 19993 | 1023 |
| 19994 | 1023 |
| 19995 | 1023 |
| 19996 | 1023 |
| 19997 | 1023 |
| 19998 | 1023 |
| 19999 | 1023 |
| 20000 | 1023 |
| 20001 | 1023 |
| 20002 | 1023 |
| 20003 | 1023 |
| 20004 | 1023 |
| 20005 | 1023 |
| 20006 | 1023 |
| 20007 | 1023 |
| 20008 | 1023 |
| 20009 | 1023 |
| 20010 | 1023 |
| 20011 | 1023 |
| 20012 | 1023 |
| 20013 | 1023 |
| 20014 | 0 |
| 20015 | 0 |
| 20016 | 0 |
| 20017 | 0 |
| 20018 | 0 |
| 20019 | 0 |
| 20020 | 0 |
| 20021 | 0 |
| 20022 | 0 |
| 20023 | 0 |
| 20024 | 0 |
| 20025 | 0 |
| 20026 | 0 |
| 20027 | 0 |
| 20028 | 0 |
| 20029 | 1023 |
| 20030 | 1023 |
| 20031 | 1023 |
| 20032 | 1023 |
| 20033 | 1023 |
| 20034 | 1023 |
| 20035 | 1023 |
| 20036 | 1023 |
| 20037 | 1023 |
| 20038 | 1023 |
| 20039 | 1023 |
| 20040 | 1023 |
| 20041 | 1023 |
| 20042 | 1023 |
| 20043 | 1023 |
| 20044 | 1023 |
| 20045 | 1023 |
| 20046 | 1023 |
| 20047 | 1023 |
| 20048 | 1023 |
| 20049 | 1023 |
| 20050 | 1023 |
| 20051 | 1023 |
| 20052 | 1023 |
| 20053 | 1023 |
| 20054 | 1023 |
| 20055 | 1023 |
| 20056 | 1023 |
| 20057 | 1023 |
| 20058 | 1023 |
| 20059 | 1023 |
| 20060 | 1023 |
| 20061 | 1023 |
| 20062 | 1023 |
| 20063 | 1023 |
| 20064 | 1023 |
| 20065 | 1023 |
| 20066 | 0 |
| 20067 | 0 |
| 20068 | 0 |
| 20069 | 0 |
| 20070 | 0 |
| 20071 | 0 |
| 20072 | 0 |
| 20073 | 0 |
| 20074 | 0 |
| 20075 | 0 |
| 20076 | 0 |
| 20077 | 0 |
| 20078 | 0 |
| 20079 | 0 |
| 20080 | 0 |
| 20081 | 1023 |
| 20082 | 1023 |
| 20083 | 1023 |
| 20084 | 1023 |
| 20085 | 1023 |
| 20086 | 1023 |
| 20087 | 1023 |
| 20088 | 1023 |
| 20089 | 1023 |
| 20090 | 1023 |
| 20091 | 1023 |
| 20092 | 1023 |
| 20093 | 1023 |
| 20094 | 1023 |
| 20095 | 1023 |
| 20096 | 1023 |
| 20097 | 1023 |
| 20098 | 1023 |
| 20099 | 1023 |
| 20100 | 1023 |
| 20101 | 1023 |
| 20102 | 1023 |
| 20103 | 1023 |
| 20104 | 1023 |
| 20105 | 1023 |
| 20106 | 1023 |
| 20107 | 1023 |
| 20108 | 1023 |
| 20109 | 1023 |
| 20110 | 1023 |
| 20111 | 1023 |
| 20112 | 1023 |
| 20113 | 1023 |
| 20114 | 1023 |
| 20115 | 1023 |
| 20116 | 1023 |
| 20117 | 1023 |
| 20118 | 0 |
| 20119 | 0 |
| 20120 | 0 |
| 20121 | 0 |
| 20122 | 0 |
| 20123 | 0 |
| 20124 | 0 |
| 20125 | 0 |
| 20126 | 0 |
| 20127 | 0 |
| 20128 | 0 |
| 20129 | 0 |
| 20130 | 0 |
| 20131 | 0 |
| 20132 | 0 |
| 20133 | 1023 |
| 20134 | 1023 |
| 20135 | 1023 |
| 20136 | 1023 |
| 20137 | 1023 |
| 20138 | 1023 |
| 20139 | 1023 |
| 20140 | 1023 |
| 20141 | 1023 |
| 20142 | 1023 |
| 20143 | 1023 |
| 20144 | 1023 |
| 20145 | 1023 |
| 20146 | 1023 |
| 20147 | 1023 |
| 20148 | 1023 |
| 20149 | 1023 |
| 20150 | 1023 |
| 20151 | 1023 |
| 20152 | 1023 |
| 20153 | 1023 |
| 20154 | 1023 |
| 20155 | 1023 |
| 20156 | 1023 |
| 20157 | 1023 |
| 20158 | 1023 |
| 20159 | 1023 |
| 20160 | 1023 |
| 20161 | 1023 |
| 20162 | 1023 |
| 20163 | 1023 |
| 20164 | 1023 |
| 20165 | 1023 |
| 20166 | 1023 |
| 20167 | 1023 |
| 20168 | 1023 |
| 20169 | 1023 |
| 20170 | 1023 |
| 20171 | 0 |
| 20172 | 0 |
| 20173 | 0 |
| 20174 | 0 |
| 20175 | 0 |
| 20176 | 0 |
| 20177 | 0 |
| 20178 | 0 |
| 20179 | 0 |
| 20180 | 0 |
| 20181 | 0 |
| 20182 | 0 |
| 20183 | 0 |
| 20184 | 1023 |
| 20185 | 1023 |
| 20186 | 1023 |
| 20187 | 1023 |
| 20188 | 1023 |
| 20189 | 1023 |
| 20190 | 1023 |
| 20191 | 1023 |
| 20192 | 1023 |
| 20193 | 1023 |
| 20194 | 1023 |
| 20195 | 1023 |
| 20196 | 1023 |
| 20197 | 1023 |
| 20198 | 1023 |
| 20199 | 1023 |
| 20200 | 1023 |
| 20201 | 1023 |
| 20202 | 1023 |
| 20203 | 1023 |
| 20204 | 1023 |
| 20205 | 1023 |
| 20206 | 1023 |
| 20207 | 1023 |
| 20208 | 1023 |
| 20209 | 1023 |
| 20210 | 1023 |
| 20211 | 1023 |
| 20212 | 1023 |
| 20213 | 1023 |
| 20214 | 1023 |
| 20215 | 1023 |
| 20216 | 1023 |
| 20217 | 1023 |
| 20218 | 1023 |
| 20219 | 1023 |
| 20220 | 1023 |
| 20221 | 1023 |
| 20222 | 0 |
| 20223 | 0 |
| 20224 | 0 |
| 20225 | 0 |
| 20226 | 1 |
| 20227 | 0 |
| 20228 | 0 |
| 20229 | 0 |
| 20230 | 0 |
| 20231 | 0 |
| 20232 | 0 |
| 20233 | 0 |
| 20234 | 0 |
| 20235 | 1023 |
| 20236 | 1023 |
| 20237 | 1023 |
| 20238 | 1023 |
| 20239 | 1023 |
| 20240 | 1023 |
| 20241 | 1023 |
| 20242 | 1023 |
| 20243 | 1023 |
| 20244 | 1023 |
| 20245 | 1023 |
| 20246 | 1023 |
| 20247 | 1023 |
| 20248 | 1023 |
| 20249 | 1023 |
| 20250 | 1023 |
| 20251 | 1023 |
| 20252 | 1023 |
| 20253 | 1023 |
| 20254 | 1023 |
| 20255 | 1023 |
| 20256 | 1023 |
| 20257 | 1023 |
| 20258 | 1023 |
| 20259 | 1023 |
| 20260 | 1023 |
| 20261 | 1023 |
| 20262 | 1023 |
| 20263 | 1023 |
| 20264 | 1023 |
| 20265 | 1023 |
| 20266 | 1023 |
| 20267 | 1023 |
| 20268 | 1023 |
| 20269 | 1023 |
| 20270 | 1023 |
| 20271 | 1023 |
| 20272 | 1023 |
| 20273 | 0 |
| 20274 | 0 |
| 20275 | 0 |
| 20276 | 0 |
| 20277 | 0 |
| 20278 | 0 |
| 20279 | 0 |
| 20280 | 0 |
| 20281 | 0 |
| 20282 | 0 |
| 20283 | 0 |
| 20284 | 0 |
| 20285 | 0 |
| 20286 | 1023 |
| 20287 | 1023 |
| 20288 | 1023 |
| 20289 | 1023 |
| 20290 | 1023 |
| 20291 | 1023 |
| 20292 | 1023 |
| 20293 | 1023 |
| 20294 | 1023 |
| 20295 | 1023 |
| 20296 | 1023 |
| 20297 | 1023 |
| 20298 | 1023 |
| 20299 | 1023 |
| 20300 | 1023 |
| 20301 | 1023 |
| 20302 | 1023 |
| 20303 | 1023 |
| 20304 | 1023 |
| 20305 | 1023 |
| 20306 | 1023 |
| 20307 | 1023 |
| 20308 | 1023 |
| 20309 | 1023 |
| 20310 | 1023 |
| 20311 | 1023 |
| 20312 | 1023 |
| 20313 | 1023 |
| 20314 | 1023 |
| 20315 | 1023 |
| 20316 | 1023 |
| 20317 | 1023 |
| 20318 | 1023 |
| 20319 | 1023 |
| 20320 | 1023 |
| 20321 | 1023 |
| 20322 | 1023 |
| 20323 | 1023 |
| 20324 | 0 |
| 20325 | 0 |
| 20326 | 0 |
| 20327 | 0 |
| 20328 | 0 |
| 20329 | 0 |
| 20330 | 0 |
| 20331 | 0 |
| 20332 | 0 |
| 20333 | 0 |
| 20334 | 0 |
| 20335 | 0 |
| 20336 | 0 |
| 20337 | 1023 |
| 20338 | 1023 |
| 20339 | 1023 |
| 20340 | 1023 |
| 20341 | 1023 |
| 20342 | 1023 |
| 20343 | 1023 |
| 20344 | 1023 |
| 20345 | 1023 |
| 20346 | 1023 |
| 20347 | 1023 |
| 20348 | 1023 |
| 20349 | 1023 |
| 20350 | 1023 |
| 20351 | 1023 |
| 20352 | 1023 |
| 20353 | 1023 |
| 20354 | 1023 |
| 20355 | 1023 |
| 20356 | 1023 |
| 20357 | 1023 |
| 20358 | 1023 |
| 20359 | 1023 |
| 20360 | 1023 |
| 20361 | 1023 |
| 20362 | 1023 |
| 20363 | 1023 |
| 20364 | 1023 |
| 20365 | 1023 |
| 20366 | 1023 |
| 20367 | 1023 |
| 20368 | 1023 |
| 20369 | 1023 |
| 20370 | 1023 |
| 20371 | 1023 |
| 20372 | 1023 |
| 20373 | 1023 |
| 20374 | 1023 |
| 20375 | 0 |
| 20376 | 0 |
| 20377 | 0 |
| 20378 | 0 |
| 20379 | 0 |
| 20380 | 0 |
| 20381 | 0 |
| 20382 | 0 |
| 20383 | 0 |
| 20384 | 0 |
| 20385 | 0 |
| 20386 | 0 |
| 20387 | 0 |
| 20388 | 1023 |
| 20389 | 1023 |
| 20390 | 1023 |
| 20391 | 1023 |
| 20392 | 1023 |
| 20393 | 1023 |
| 20394 | 1023 |
| 20395 | 1023 |
| 20396 | 1023 |
| 20397 | 1023 |
| 20398 | 1023 |
| 20399 | 1023 |
| 20400 | 1023 |
| 20401 | 1023 |
| 20402 | 1023 |
| 20403 | 1023 |
| 20404 | 1023 |
| 20405 | 1023 |
| 20406 | 1023 |
| 20407 | 1023 |
| 20408 | 1023 |
| 20409 | 1023 |
| 20410 | 1023 |
| 20411 | 1023 |
| 20412 | 1023 |
| 20413 | 1023 |
| 20414 | 1023 |
| 20415 | 1023 |
| 20416 | 1023 |
| 20417 | 1023 |
| 20418 | 1023 |
| 20419 | 1023 |
| 20420 | 1023 |
| 20421 | 1023 |
| 20422 | 1023 |
| 20423 | 1023 |
| 20424 | 1023 |
| 20425 | 1023 |
| 20426 | 0 |
| 20427 | 0 |
| 20428 | 0 |
| 20429 | 0 |
| 20430 | 0 |
| 20431 | 0 |
| 20432 | 0 |
| 20433 | 0 |
| 20434 | 0 |
| 20435 | 0 |
| 20436 | 0 |
| 20437 | 0 |
| 20438 | 0 |
| 20439 | 1023 |
| 20440 | 1023 |
| 20441 | 1023 |
| 20442 | 1023 |
| 20443 | 1023 |
| 20444 | 1023 |
| 20445 | 1023 |
| 20446 | 1023 |
| 20447 | 1023 |
| 20448 | 1023 |
| 20449 | 1023 |
| 20450 | 1023 |
| 20451 | 1023 |
| 20452 | 1023 |
| 20453 | 1023 |
| 20454 | 1023 |
| 20455 | 1023 |
| 20456 | 1023 |
| 20457 | 1023 |
| 20458 | 1023 |
| 20459 | 1023 |
| 20460 | 1023 |
| 20461 | 1023 |
| 20462 | 1023 |
| 20463 | 1023 |
| 20464 | 1023 |
| 20465 | 1023 |
| 20466 | 1023 |
| 20467 | 1023 |
| 20468 | 1023 |
| 20469 | 1023 |
| 20470 | 1023 |
| 20471 | 1023 |
| 20472 | 1023 |
| 20473 | 1023 |
| 20474 | 1023 |
| 20475 | 1023 |
| 20476 | 1023 |
| 20477 | 0 |
| 20478 | 0 |
| 20479 | 0 |
| 20480 | 0 |
| 20481 | 0 |
| 20482 | 0 |
| 20483 | 0 |
| 20484 | 0 |
| 20485 | 0 |
| 20486 | 0 |
| 20487 | 0 |
| 20488 | 0 |
| 20489 | 0 |
| 20490 | 1023 |
| 20491 | 1023 |
| 20492 | 1023 |
| 20493 | 1023 |
| 20494 | 1023 |
| 20495 | 1023 |
| 20496 | 1023 |
| 20497 | 1023 |
| 20498 | 1023 |
| 20499 | 1023 |
| 20500 | 1023 |
| 20501 | 1023 |
| 20502 | 1023 |
| 20503 | 1023 |
| 20504 | 1023 |
| 20505 | 1023 |
| 20506 | 1023 |
| 20507 | 1023 |
| 20508 | 1023 |
| 20509 | 1023 |
| 20510 | 1023 |
| 20511 | 1023 |
| 20512 | 1023 |
| 20513 | 1023 |
| 20514 | 1023 |
| 20515 | 1023 |
| 20516 | 1023 |
| 20517 | 1023 |
| 20518 | 1023 |
| 20519 | 1023 |
| 20520 | 1023 |
| 20521 | 1023 |
| 20522 | 1023 |
| 20523 | 1023 |
| 20524 | 1023 |
| 20525 | 1023 |
| 20526 | 1023 |
| 20527 | 1023 |
| 20528 | 0 |
| 20529 | 0 |
| 20530 | 0 |
| 20531 | 0 |
| 20532 | 0 |
| 20533 | 0 |
| 20534 | 0 |
| 20535 | 0 |
| 20536 | 0 |
| 20537 | 0 |
| 20538 | 0 |
| 20539 | 0 |
| 20540 | 0 |
| 20541 | 1023 |
| 20542 | 1023 |
| 20543 | 1023 |
| 20544 | 1023 |
| 20545 | 1023 |
| 20546 | 1023 |
| 20547 | 1023 |
| 20548 | 1023 |
| 20549 | 1023 |
| 20550 | 1023 |
| 20551 | 1023 |
| 20552 | 1023 |
| 20553 | 1023 |
| 20554 | 1023 |
| 20555 | 1023 |
| 20556 | 1023 |
| 20557 | 1023 |
| 20558 | 1023 |
| 20559 | 1023 |
| 20560 | 1023 |
| 20561 | 1023 |
| 20562 | 1023 |
| 20563 | 1023 |
| 20564 | 1023 |
| 20565 | 1023 |
| 20566 | 1023 |
| 20567 | 1023 |
| 20568 | 1023 |
| 20569 | 1023 |
| 20570 | 1023 |
| 20571 | 1023 |
| 20572 | 1023 |
| 20573 | 1023 |
| 20574 | 1023 |
| 20575 | 1023 |
| 20576 | 1023 |
| 20577 | 1023 |
| 20578 | 1023 |
| 20579 | 0 |
| 20580 | 0 |
| 20581 | 0 |
| 20582 | 0 |
| 20583 | 0 |
| 20584 | 0 |
| 20585 | 0 |
| 20586 | 0 |
| 20587 | 0 |
| 20588 | 0 |
| 20589 | 0 |
| 20590 | 1 |
| 20591 | 0 |
| 20592 | 0 |
| 20593 | 1023 |
| 20594 | 1023 |
| 20595 | 1023 |
| 20596 | 1023 |
| 20597 | 1023 |
| 20598 | 1023 |
| 20599 | 1023 |
| 20600 | 1023 |
| 20601 | 1023 |
| 20602 | 1023 |
| 20603 | 1023 |
| 20604 | 1023 |
| 20605 | 1023 |
| 20606 | 1023 |
| 20607 | 1023 |
| 20608 | 1023 |
| 20609 | 1023 |
| 20610 | 1023 |
| 20611 | 1023 |
| 20612 | 1023 |
| 20613 | 1023 |
| 20614 | 1023 |
| 20615 | 1023 |
| 20616 | 1023 |
| 20617 | 1023 |
| 20618 | 1023 |
| 20619 | 1023 |
| 20620 | 1023 |
| 20621 | 1023 |
| 20622 | 1023 |
| 20623 | 1023 |
| 20624 | 1023 |
| 20625 | 1023 |
| 20626 | 1023 |
| 20627 | 1023 |
| 20628 | 1023 |
| 20629 | 1023 |
| 20630 | 0 |
| 20631 | 0 |
| 20632 | 0 |
| 20633 | 0 |
| 20634 | 0 |
| 20635 | 0 |
| 20636 | 0 |
| 20637 | 0 |
| 20638 | 0 |
| 20639 | 0 |
| 20640 | 0 |
| 20641 | 0 |
| 20642 | 0 |
| 20643 | 0 |
| 20644 | 1023 |
| 20645 | 1023 |
| 20646 | 1023 |
| 20647 | 1023 |
| 20648 | 1023 |
| 20649 | 1023 |
| 20650 | 1023 |
| 20651 | 1023 |
| 20652 | 1023 |
| 20653 | 1023 |
| 20654 | 1023 |
| 20655 | 1023 |
| 20656 | 1023 |
| 20657 | 1023 |
| 20658 | 1023 |
| 20659 | 1023 |
| 20660 | 1023 |
| 20661 | 1023 |
| 20662 | 1023 |
| 20663 | 1023 |
| 20664 | 1023 |
| 20665 | 1023 |
| 20666 | 1023 |
| 20667 | 1023 |
| 20668 | 1023 |
| 20669 | 1023 |
| 20670 | 1023 |
| 20671 | 1023 |
| 20672 | 1023 |
| 20673 | 1023 |
| 20674 | 1023 |
| 20675 | 1023 |
| 20676 | 1023 |
| 20677 | 1023 |
| 20678 | 1023 |
| 20679 | 1023 |
| 20680 | 1023 |
| 20681 | 1023 |
| 20682 | 0 |
| 20683 | 0 |
| 20684 | 0 |
| 20685 | 0 |
| 20686 | 0 |
| 20687 | 0 |
| 20688 | 0 |
| 20689 | 0 |
| 20690 | 0 |
| 20691 | 0 |
| 20692 | 0 |
| 20693 | 0 |
| 20694 | 0 |
| 20695 | 0 |
| 20696 | 1023 |
| 20697 | 1023 |
| 20698 | 1023 |
| 20699 | 1023 |
| 20700 | 1023 |
| 20701 | 1023 |
| 20702 | 1023 |
| 20703 | 1023 |
| 20704 | 1023 |
| 20705 | 1023 |
| 20706 | 1023 |
| 20707 | 1023 |
| 20708 | 1023 |
| 20709 | 1023 |
| 20710 | 1023 |
| 20711 | 1023 |
| 20712 | 1023 |
| 20713 | 1023 |
| 20714 | 1023 |
| 20715 | 1023 |
| 20716 | 1023 |
| 20717 | 1023 |
| 20718 | 1023 |
| 20719 | 1023 |
| 20720 | 1023 |
| 20721 | 1023 |
| 20722 | 1023 |
| 20723 | 1023 |
| 20724 | 1023 |
| 20725 | 1023 |
| 20726 | 1023 |
| 20727 | 1023 |
| 20728 | 1023 |
| 20729 | 1023 |
| 20730 | 1023 |
| 20731 | 1023 |
| 20732 | 1023 |
| 20733 | 1023 |
| 20734 | 0 |
| 20735 | 0 |
| 20736 | 0 |
| 20737 | 0 |
| 20738 | 0 |
| 20739 | 0 |
| 20740 | 0 |
| 20741 | 0 |
| 20742 | 0 |
| 20743 | 0 |
| 20744 | 0 |
| 20745 | 0 |
| 20746 | 0 |
| 20747 | 1023 |
| 20748 | 1023 |
| 20749 | 1023 |
| 20750 | 1023 |
| 20751 | 1023 |
| 20752 | 1023 |
| 20753 | 1023 |
| 20754 | 1023 |
| 20755 | 1023 |
| 20756 | 1023 |
| 20757 | 1023 |
| 20758 | 1023 |
| 20759 | 1023 |
| 20760 | 1023 |
| 20761 | 1023 |
| 20762 | 1023 |
| 20763 | 1023 |
| 20764 | 1023 |
| 20765 | 1023 |
| 20766 | 1023 |
| 20767 | 1023 |
| 20768 | 1023 |
| 20769 | 1023 |
| 20770 | 1023 |
| 20771 | 1023 |
| 20772 | 1023 |
| 20773 | 1023 |
| 20774 | 1023 |
| 20775 | 1023 |
| 20776 | 1023 |
| 20777 | 1023 |
| 20778 | 1023 |
| 20779 | 1023 |
| 20780 | 1023 |
| 20781 | 1023 |
| 20782 | 1023 |
| 20783 | 1023 |
| 20784 | 1023 |
| 20785 | 0 |
| 20786 | 0 |
| 20787 | 0 |
| 20788 | 0 |
| 20789 | 0 |
| 20790 | 0 |
| 20791 | 0 |
| 20792 | 0 |
| 20793 | 0 |
| 20794 | 0 |
| 20795 | 0 |
| 20796 | 0 |
| 20797 | 0 |
| 20798 | 1023 |
| 20799 | 1023 |
| 20800 | 1023 |
| 20801 | 1023 |
| 20802 | 1023 |
| 20803 | 1023 |
| 20804 | 1023 |
| 20805 | 1023 |
| 20806 | 1023 |
| 20807 | 1023 |
| 20808 | 1023 |
| 20809 | 1023 |
| 20810 | 1023 |
| 20811 | 1023 |
| 20812 | 1023 |
| 20813 | 1023 |
| 20814 | 1023 |
| 20815 | 1023 |
| 20816 | 1023 |
| 20817 | 1023 |
| 20818 | 1023 |
| 20819 | 1023 |
| 20820 | 1023 |
| 20821 | 1023 |
| 20822 | 1023 |
| 20823 | 1023 |
| 20824 | 1023 |
| 20825 | 1023 |
| 20826 | 1023 |
| 20827 | 1023 |
| 20828 | 1023 |
| 20829 | 1023 |
| 20830 | 1023 |
| 20831 | 1023 |
| 20832 | 1023 |
| 20833 | 1023 |
| 20834 | 1023 |
| 20835 | 1023 |
| 20836 | 0 |
| 20837 | 0 |
| 20838 | 0 |
| 20839 | 0 |
| 20840 | 0 |
| 20841 | 0 |
| 20842 | 0 |
| 20843 | 0 |
| 20844 | 0 |
| 20845 | 0 |
| 20846 | 0 |
| 20847 | 0 |
| 20848 | 0 |
| 20849 | 1023 |
| 20850 | 1023 |
| 20851 | 1023 |
| 20852 | 1023 |
| 20853 | 1023 |
| 20854 | 1023 |
| 20855 | 1023 |
| 20856 | 1023 |
| 20857 | 1023 |
| 20858 | 1023 |
| 20859 | 1023 |
| 20860 | 1023 |
| 20861 | 1023 |
| 20862 | 1023 |
| 20863 | 1023 |
| 20864 | 1023 |
| 20865 | 1023 |
| 20866 | 1023 |
| 20867 | 1023 |
| 20868 | 1023 |
| 20869 | 1023 |
| 20870 | 1023 |
| 20871 | 1023 |
| 20872 | 1023 |
| 20873 | 1023 |
| 20874 | 1023 |
| 20875 | 1023 |
| 20876 | 1023 |
| 20877 | 1023 |
| 20878 | 1023 |
| 20879 | 1023 |
| 20880 | 1023 |
| 20881 | 1023 |
| 20882 | 1023 |
| 20883 | 1023 |
| 20884 | 1023 |
| 20885 | 1023 |
| 20886 | 1023 |
| 20887 | 0 |
| 20888 | 0 |
| 20889 | 0 |
| 20890 | 0 |
| 20891 | 0 |
| 20892 | 0 |
| 20893 | 0 |
| 20894 | 0 |
| 20895 | 0 |
| 20896 | 0 |
| 20897 | 0 |
| 20898 | 0 |
| 20899 | 0 |
| 20900 | 1023 |
| 20901 | 1023 |
| 20902 | 1023 |
| 20903 | 1023 |
| 20904 | 1023 |
| 20905 | 1023 |
| 20906 | 1023 |
| 20907 | 1023 |
| 20908 | 1023 |
| 20909 | 1023 |
| 20910 | 1023 |
| 20911 | 1023 |
| 20912 | 1023 |
| 20913 | 1023 |
| 20914 | 1023 |
| 20915 | 1023 |
| 20916 | 1023 |
| 20917 | 1023 |
| 20918 | 1023 |
| 20919 | 1023 |
| 20920 | 1023 |
| 20921 | 1023 |
| 20922 | 1023 |
| 20923 | 1023 |
| 20924 | 1023 |
| 20925 | 1023 |
| 20926 | 1023 |
| 20927 | 1023 |
| 20928 | 1023 |
| 20929 | 1023 |
| 20930 | 1023 |
| 20931 | 1023 |
| 20932 | 1023 |
| 20933 | 1023 |
| 20934 | 1023 |
| 20935 | 1023 |
| 20936 | 1023 |
| 20937 | 1023 |
| 20938 | 0 |
| 20939 | 0 |
| 20940 | 0 |
| 20941 | 0 |
| 20942 | 0 |
| 20943 | 0 |
| 20944 | 0 |
| 20945 | 0 |
| 20946 | 0 |
| 20947 | 0 |
| 20948 | 0 |
| 20949 | 0 |
| 20950 | 0 |
| 20951 | 1023 |
| 20952 | 1023 |
| 20953 | 1023 |
| 20954 | 1023 |
| 20955 | 1023 |
| 20956 | 1023 |
| 20957 | 1023 |
| 20958 | 1023 |
| 20959 | 1023 |
| 20960 | 1023 |
| 20961 | 1023 |
| 20962 | 1023 |
| 20963 | 1023 |
| 20964 | 1023 |
| 20965 | 1023 |
| 20966 | 1023 |
| 20967 | 1023 |
| 20968 | 1023 |
| 20969 | 1023 |
| 20970 | 1023 |
| 20971 | 1023 |
| 20972 | 1023 |
| 20973 | 1023 |
| 20974 | 1023 |
| 20975 | 1023 |
| 20976 | 1023 |
| 20977 | 1023 |
| 20978 | 1023 |
| 20979 | 1023 |
| 20980 | 1023 |
| 20981 | 1023 |
| 20982 | 1023 |
| 20983 | 1023 |
| 20984 | 1023 |
| 20985 | 1023 |
| 20986 | 1023 |
| 20987 | 1023 |
| 20988 | 1023 |
| 20989 | 0 |
| 20990 | 0 |
| 20991 | 0 |
| 20992 | 0 |
| 20993 | 0 |
| 20994 | 0 |
| 20995 | 0 |
| 20996 | 0 |
| 20997 | 0 |
| 20998 | 0 |
| 20999 | 0 |
| 21000 | 0 |
| 21001 | 0 |
| 21002 | 1023 |
| 21003 | 1023 |
| 21004 | 1023 |
| 21005 | 1023 |
| 21006 | 1023 |
| 21007 | 1023 |
| 21008 | 1023 |
| 21009 | 1023 |
| 21010 | 1023 |
| 21011 | 1023 |
| 21012 | 1023 |
| 21013 | 1023 |
| 21014 | 1023 |
| 21015 | 1023 |
| 21016 | 1023 |
| 21017 | 1023 |
| 21018 | 1023 |
| 21019 | 1023 |
| 21020 | 1023 |
| 21021 | 1023 |
| 21022 | 1023 |
| 21023 | 1023 |
| 21024 | 1023 |
| 21025 | 1023 |
| 21026 | 1023 |
| 21027 | 1023 |
| 21028 | 1023 |
| 21029 | 1023 |
| 21030 | 1023 |
| 21031 | 1023 |
| 21032 | 1023 |
| 21033 | 1023 |
| 21034 | 1023 |
| 21035 | 1023 |
| 21036 | 1023 |
| 21037 | 1023 |
| 21038 | 1023 |
| 21039 | 1023 |
| 21040 | 0 |
| 21041 | 0 |
| 21042 | 0 |
| 21043 | 0 |
| 21044 | 0 |
| 21045 | 0 |
| 21046 | 0 |
| 21047 | 0 |
| 21048 | 0 |
| 21049 | 0 |
| 21050 | 0 |
| 21051 | 0 |
| 21052 | 0 |
| 21053 | 1023 |
| 21054 | 1023 |
| 21055 | 1023 |
| 21056 | 1023 |
| 21057 | 1023 |
| 21058 | 1023 |
| 21059 | 1023 |
| 21060 | 1023 |
| 21061 | 1023 |
| 21062 | 1023 |
| 21063 | 1023 |
| 21064 | 1023 |
| 21065 | 1023 |
| 21066 | 1023 |
| 21067 | 1023 |
| 21068 | 1023 |
| 21069 | 1023 |
| 21070 | 1023 |
| 21071 | 1023 |
| 21072 | 1023 |
| 21073 | 1023 |
| 21074 | 1023 |
| 21075 | 1023 |
| 21076 | 1023 |
| 21077 | 1023 |
| 21078 | 1023 |
| 21079 | 1023 |
| 21080 | 1023 |
| 21081 | 1023 |
| 21082 | 1023 |
| 21083 | 1023 |
| 21084 | 1023 |
| 21085 | 1023 |
| 21086 | 1023 |
| 21087 | 1023 |
| 21088 | 1023 |
| 21089 | 1023 |
| 21090 | 1023 |
| 21091 | 0 |
| 21092 | 0 |
| 21093 | 0 |
| 21094 | 0 |
| 21095 | 0 |
| 21096 | 0 |
| 21097 | 0 |
| 21098 | 0 |
| 21099 | 0 |
| 21100 | 0 |
| 21101 | 0 |
| 21102 | 0 |
| 21103 | 0 |
| 21104 | 0 |
| 21105 | 1023 |
| 21106 | 1023 |
| 21107 | 1023 |
| 21108 | 1023 |
| 21109 | 1023 |
| 21110 | 1023 |
| 21111 | 1023 |
| 21112 | 1023 |
| 21113 | 1023 |
| 21114 | 1023 |
| 21115 | 1023 |
| 21116 | 1023 |
| 21117 | 1023 |
| 21118 | 1023 |
| 21119 | 1023 |
| 21120 | 1023 |
| 21121 | 1023 |
| 21122 | 1023 |
| 21123 | 1023 |
| 21124 | 1023 |
| 21125 | 1023 |
| 21126 | 1023 |
| 21127 | 1023 |
| 21128 | 1023 |
| 21129 | 1023 |
| 21130 | 1023 |
| 21131 | 1023 |
| 21132 | 1023 |
| 21133 | 1023 |
| 21134 | 1023 |
| 21135 | 1023 |
| 21136 | 1023 |
| 21137 | 1023 |
| 21138 | 1023 |
| 21139 | 1023 |
| 21140 | 1023 |
| 21141 | 1023 |
| 21142 | 0 |
| 21143 | 0 |
| 21144 | 0 |
| 21145 | 0 |
| 21146 | 0 |
| 21147 | 0 |
| 21148 | 0 |
| 21149 | 0 |
| 21150 | 0 |
| 21151 | 0 |
| 21152 | 0 |
| 21153 | 0 |
| 21154 | 0 |
| 21155 | 0 |
| 21156 | 1023 |
| 21157 | 1023 |
| 21158 | 1023 |
| 21159 | 1023 |
| 21160 | 1023 |
| 21161 | 1023 |
| 21162 | 1023 |
| 21163 | 1023 |
| 21164 | 1023 |
| 21165 | 1023 |
| 21166 | 1023 |
| 21167 | 1023 |
| 21168 | 1023 |
| 21169 | 1023 |
| 21170 | 1023 |
| 21171 | 1023 |
| 21172 | 1023 |
| 21173 | 1023 |
| 21174 | 1023 |
| 21175 | 1023 |
| 21176 | 1023 |
| 21177 | 1023 |
| 21178 | 1023 |
| 21179 | 1023 |
| 21180 | 1023 |
| 21181 | 1023 |
| 21182 | 1023 |
| 21183 | 1023 |
| 21184 | 1023 |
| 21185 | 1023 |
| 21186 | 1023 |
| 21187 | 1023 |
| 21188 | 1023 |
| 21189 | 1023 |
| 21190 | 1023 |
| 21191 | 1023 |
| 21192 | 1023 |
| 21193 | 1023 |
| 21194 | 0 |
| 21195 | 0 |
| 21196 | 0 |
| 21197 | 0 |
| 21198 | 0 |
| 21199 | 0 |
| 21200 | 0 |
| 21201 | 0 |
| 21202 | 0 |
| 21203 | 0 |
| 21204 | 0 |
| 21205 | 0 |
| 21206 | 0 |
| 21207 | 0 |
| 21208 | 1023 |
| 21209 | 1023 |
| 21210 | 1023 |
| 21211 | 1023 |
| 21212 | 1023 |
| 21213 | 1023 |
| 21214 | 1023 |
| 21215 | 1023 |
| 21216 | 1023 |
| 21217 | 1023 |
| 21218 | 1023 |
| 21219 | 1023 |
| 21220 | 1023 |
| 21221 | 1023 |
| 21222 | 1023 |
| 21223 | 1023 |
| 21224 | 1023 |
| 21225 | 1023 |
| 21226 | 1023 |
| 21227 | 1023 |
| 21228 | 1023 |
| 21229 | 1023 |
| 21230 | 1023 |
| 21231 | 1023 |
| 21232 | 1023 |
| 21233 | 1023 |
| 21234 | 1023 |
| 21235 | 1023 |
| 21236 | 1023 |
| 21237 | 1023 |
| 21238 | 1023 |
| 21239 | 1023 |
| 21240 | 1023 |
| 21241 | 1023 |
| 21242 | 1023 |
| 21243 | 1023 |
| 21244 | 1023 |
| 21245 | 0 |
| 21246 | 0 |
| 21247 | 0 |
| 21248 | 0 |
| 21249 | 0 |
| 21250 | 0 |
| 21251 | 0 |
| 21252 | 0 |
| 21253 | 0 |
| 21254 | 0 |
| 21255 | 0 |
| 21256 | 0 |
| 21257 | 0 |
| 21258 | 0 |
| 21259 | 0 |
| 21260 | 1023 |
| 21261 | 1023 |
| 21262 | 1023 |
| 21263 | 1023 |
| 21264 | 1023 |
| 21265 | 1023 |
| 21266 | 1023 |
| 21267 | 1023 |
| 21268 | 1023 |
| 21269 | 1023 |
| 21270 | 1023 |
| 21271 | 1023 |
| 21272 | 1023 |
| 21273 | 1023 |
| 21274 | 1023 |
| 21275 | 1023 |
| 21276 | 1023 |
| 21277 | 1023 |
| 21278 | 1023 |
| 21279 | 1023 |
| 21280 | 1023 |
| 21281 | 1023 |
| 21282 | 1023 |
| 21283 | 1023 |
| 21284 | 1023 |
| 21285 | 1023 |
| 21286 | 1023 |
| 21287 | 1023 |
| 21288 | 1023 |
| 21289 | 1023 |
| 21290 | 1023 |
| 21291 | 1023 |
| 21292 | 1023 |
| 21293 | 1023 |
| 21294 | 1023 |
| 21295 | 1023 |
| 21296 | 1023 |
| 21297 | 0 |
| 21298 | 0 |
| 21299 | 0 |
| 21300 | 0 |
| 21301 | 0 |
| 21302 | 0 |
| 21303 | 0 |
| 21304 | 0 |
| 21305 | 0 |
| 21306 | 0 |
| 21307 | 0 |
| 21308 | 0 |
| 21309 | 0 |
| 21310 | 0 |
| 21311 | 0 |
| 21312 | 1023 |
| 21313 | 1023 |
| 21314 | 1023 |
| 21315 | 1023 |
| 21316 | 1023 |
| 21317 | 1023 |
| 21318 | 1023 |
| 21319 | 1023 |
| 21320 | 1023 |
| 21321 | 1023 |
| 21322 | 1023 |
| 21323 | 1023 |
| 21324 | 1023 |
| 21325 | 1023 |
| 21326 | 1023 |
| 21327 | 1023 |
| 21328 | 1023 |
| 21329 | 1023 |
| 21330 | 1023 |
| 21331 | 1023 |
| 21332 | 1023 |
| 21333 | 1023 |
| 21334 | 1023 |
| 21335 | 1023 |
| 21336 | 1023 |
| 21337 | 1023 |
| 21338 | 1023 |
| 21339 | 1023 |
| 21340 | 1023 |
| 21341 | 1023 |
| 21342 | 1023 |
| 21343 | 1023 |
| 21344 | 1023 |
| 21345 | 1023 |
| 21346 | 1023 |
| 21347 | 1023 |
| 21348 | 1023 |
| 21349 | 0 |
| 21350 | 0 |
| 21351 | 0 |
| 21352 | 0 |
| 21353 | 0 |
| 21354 | 0 |
| 21355 | 0 |
| 21356 | 0 |
| 21357 | 0 |
| 21358 | 0 |
| 21359 | 0 |
| 21360 | 0 |
| 21361 | 0 |
| 21362 | 0 |
| 21363 | 0 |
| 21364 | 1023 |
| 21365 | 1023 |
| 21366 | 1023 |
| 21367 | 1023 |
| 21368 | 1023 |
| 21369 | 1023 |
| 21370 | 1023 |
| 21371 | 1023 |
| 21372 | 1023 |
| 21373 | 1023 |
| 21374 | 1023 |
| 21375 | 1023 |
| 21376 | 1023 |
| 21377 | 1023 |
| 21378 | 1023 |
| 21379 | 1023 |
| 21380 | 1023 |
| 21381 | 1023 |
| 21382 | 1023 |
| 21383 | 1023 |
| 21384 | 1023 |
| 21385 | 1023 |
| 21386 | 1023 |
| 21387 | 1023 |
| 21388 | 1023 |
| 21389 | 1023 |
| 21390 | 1023 |
| 21391 | 1023 |
| 21392 | 1023 |
| 21393 | 1023 |
| 21394 | 1023 |
| 21395 | 1023 |
| 21396 | 1023 |
| 21397 | 1023 |
| 21398 | 1023 |
| 21399 | 1023 |
| 21400 | 1023 |
| 21401 | 1023 |
| 21402 | 0 |
| 21403 | 0 |
| 21404 | 0 |
| 21405 | 0 |
| 21406 | 0 |
| 21407 | 0 |
| 21408 | 0 |
| 21409 | 0 |
| 21410 | 0 |
| 21411 | 0 |
| 21412 | 0 |
| 21413 | 0 |
| 21414 | 0 |
| 21415 | 1023 |
| 21416 | 1023 |
| 21417 | 1023 |
| 21418 | 1023 |
| 21419 | 1023 |
| 21420 | 1023 |
| 21421 | 1023 |
| 21422 | 1023 |
| 21423 | 1023 |
| 21424 | 1023 |
| 21425 | 1023 |
| 21426 | 1023 |
| 21427 | 1023 |
| 21428 | 1023 |
| 21429 | 1023 |
| 21430 | 1023 |
| 21431 | 1023 |
| 21432 | 1023 |
| 21433 | 1023 |
| 21434 | 1023 |
| 21435 | 1023 |
| 21436 | 1023 |
| 21437 | 1023 |
| 21438 | 1023 |
| 21439 | 1023 |
| 21440 | 1023 |
| 21441 | 1023 |
| 21442 | 1023 |
| 21443 | 1023 |
| 21444 | 1023 |
| 21445 | 1023 |
| 21446 | 1023 |
| 21447 | 1023 |
| 21448 | 1023 |
| 21449 | 1023 |
| 21450 | 1023 |
| 21451 | 1023 |
| 21452 | 1023 |
| 21453 | 0 |
| 21454 | 0 |
| 21455 | 0 |
| 21456 | 0 |
| 21457 | 0 |
| 21458 | 0 |
| 21459 | 0 |
| 21460 | 0 |
| 21461 | 0 |
| 21462 | 0 |
| 21463 | 0 |
| 21464 | 0 |
| 21465 | 0 |
| 21466 | 1023 |
| 21467 | 1023 |
| 21468 | 1023 |
| 21469 | 1023 |
| 21470 | 1023 |
| 21471 | 1023 |
| 21472 | 1023 |
| 21473 | 1023 |
| 21474 | 1023 |
| 21475 | 1023 |
| 21476 | 1023 |
| 21477 | 1023 |
| 21478 | 1023 |
| 21479 | 1023 |
| 21480 | 1023 |
| 21481 | 1023 |
| 21482 | 1023 |
| 21483 | 1023 |
| 21484 | 1023 |
| 21485 | 1023 |
| 21486 | 1023 |
| 21487 | 1023 |
| 21488 | 1023 |
| 21489 | 1023 |
| 21490 | 1023 |
| 21491 | 1023 |
| 21492 | 1023 |
| 21493 | 1023 |
| 21494 | 1023 |
| 21495 | 1023 |
| 21496 | 1023 |
| 21497 | 1023 |
| 21498 | 1023 |
| 21499 | 1023 |
| 21500 | 1023 |
| 21501 | 1023 |
| 21502 | 1023 |
| 21503 | 1023 |
| 21504 | 0 |
| 21505 | 0 |
| 21506 | 0 |
| 21507 | 0 |
| 21508 | 0 |
| 21509 | 0 |
| 21510 | 0 |
| 21511 | 0 |
| 21512 | 0 |
| 21513 | 0 |
| 21514 | 0 |
| 21515 | 0 |
| 21516 | 0 |
| 21517 | 1023 |
| 21518 | 1023 |
| 21519 | 1023 |
| 21520 | 1023 |
| 21521 | 1023 |
| 21522 | 1023 |
| 21523 | 1023 |
| 21524 | 1023 |
| 21525 | 1023 |
| 21526 | 1023 |
| 21527 | 1023 |
| 21528 | 1023 |
| 21529 | 1023 |
| 21530 | 1023 |
| 21531 | 1023 |
| 21532 | 1023 |
| 21533 | 1023 |
| 21534 | 1023 |
| 21535 | 1023 |
| 21536 | 1023 |
| 21537 | 1023 |
| 21538 | 1023 |
| 21539 | 1023 |
| 21540 | 1023 |
| 21541 | 1023 |
| 21542 | 1023 |
| 21543 | 1023 |
| 21544 | 1023 |
| 21545 | 1023 |
| 21546 | 1023 |
| 21547 | 1023 |
| 21548 | 1023 |
| 21549 | 1023 |
| 21550 | 1023 |
| 21551 | 1023 |
| 21552 | 1023 |
| 21553 | 1023 |
| 21554 | 1023 |
| 21555 | 0 |
| 21556 | 1 |
| 21557 | 1 |
| 21558 | 0 |
| 21559 | 0 |
| 21560 | 0 |
| 21561 | 0 |
| 21562 | 0 |
| 21563 | 0 |
| 21564 | 0 |
| 21565 | 0 |
| 21566 | 0 |
| 21567 | 0 |
| 21568 | 1023 |
| 21569 | 1023 |
| 21570 | 1023 |
| 21571 | 1023 |
| 21572 | 1023 |
| 21573 | 1023 |
| 21574 | 1023 |
| 21575 | 1023 |
| 21576 | 1023 |
| 21577 | 1023 |
| 21578 | 1023 |
| 21579 | 1023 |
| 21580 | 1023 |
| 21581 | 1023 |
| 21582 | 1023 |
| 21583 | 1023 |
| 21584 | 1023 |
| 21585 | 1023 |
| 21586 | 1023 |
| 21587 | 1023 |
| 21588 | 1023 |
| 21589 | 1023 |
| 21590 | 1023 |
| 21591 | 1023 |
| 21592 | 1023 |
| 21593 | 1023 |
| 21594 | 1023 |
| 21595 | 1023 |
| 21596 | 1023 |
| 21597 | 1023 |
| 21598 | 1023 |
| 21599 | 1023 |
| 21600 | 1023 |
| 21601 | 1023 |
| 21602 | 1023 |
| 21603 | 1023 |
| 21604 | 1023 |
| 21605 | 1023 |
| 21606 | 0 |
| 21607 | 0 |
| 21608 | 0 |
| 21609 | 0 |
| 21610 | 0 |
| 21611 | 0 |
| 21612 | 0 |
| 21613 | 0 |
| 21614 | 0 |
| 21615 | 0 |
| 21616 | 0 |
| 21617 | 0 |
| 21618 | 0 |
| 21619 | 1023 |
| 21620 | 1023 |
| 21621 | 1023 |
| 21622 | 1023 |
| 21623 | 1023 |
| 21624 | 1023 |
| 21625 | 1023 |
| 21626 | 1023 |
| 21627 | 1023 |
| 21628 | 1023 |
| 21629 | 1023 |
| 21630 | 1023 |
| 21631 | 1023 |
| 21632 | 1023 |
| 21633 | 1023 |
| 21634 | 1023 |
| 21635 | 1023 |
| 21636 | 1023 |
| 21637 | 1023 |
| 21638 | 1023 |
| 21639 | 1023 |
| 21640 | 1023 |
| 21641 | 1023 |
| 21642 | 1023 |
| 21643 | 1023 |
| 21644 | 1023 |
| 21645 | 1023 |
| 21646 | 1023 |
| 21647 | 1023 |
| 21648 | 1023 |
| 21649 | 1023 |
| 21650 | 1023 |
| 21651 | 1023 |
| 21652 | 1023 |
| 21653 | 1023 |
| 21654 | 1023 |
| 21655 | 1023 |
| 21656 | 1023 |
| 21657 | 0 |
| 21658 | 0 |
| 21659 | 0 |
| 21660 | 0 |
| 21661 | 0 |
| 21662 | 0 |
| 21663 | 0 |
| 21664 | 0 |
| 21665 | 0 |
| 21666 | 0 |
| 21667 | 0 |
| 21668 | 0 |
| 21669 | 0 |
| 21670 | 1023 |
| 21671 | 1023 |
| 21672 | 1023 |
| 21673 | 1023 |
| 21674 | 1023 |
| 21675 | 1023 |
| 21676 | 1023 |
| 21677 | 1023 |
| 21678 | 1023 |
| 21679 | 1023 |
| 21680 | 1023 |
| 21681 | 1023 |
| 21682 | 1023 |
| 21683 | 1023 |
| 21684 | 1023 |
| 21685 | 1023 |
| 21686 | 1023 |
| 21687 | 1023 |
| 21688 | 1023 |
| 21689 | 1023 |
| 21690 | 1023 |
| 21691 | 1023 |
| 21692 | 1023 |
| 21693 | 1023 |
| 21694 | 1023 |
| 21695 | 1023 |
| 21696 | 1023 |
| 21697 | 1023 |
| 21698 | 1023 |
| 21699 | 1023 |
| 21700 | 1023 |
| 21701 | 1023 |
| 21702 | 1023 |
| 21703 | 1023 |
| 21704 | 1023 |
| 21705 | 1023 |
| 21706 | 1023 |
| 21707 | 1023 |
| 21708 | 0 |
| 21709 | 0 |
| 21710 | 0 |
| 21711 | 0 |
| 21712 | 0 |
| 21713 | 0 |
| 21714 | 0 |
| 21715 | 0 |
| 21716 | 0 |
| 21717 | 0 |
| 21718 | 0 |
| 21719 | 0 |
| 21720 | 0 |
| 21721 | 0 |
| 21722 | 1023 |
| 21723 | 1023 |
| 21724 | 1023 |
| 21725 | 1023 |
| 21726 | 1023 |
| 21727 | 1023 |
| 21728 | 1023 |
| 21729 | 1023 |
| 21730 | 1023 |
| 21731 | 1023 |
| 21732 | 1023 |
| 21733 | 1023 |
| 21734 | 1023 |
| 21735 | 1023 |
| 21736 | 1023 |
| 21737 | 1023 |
| 21738 | 1023 |
| 21739 | 1023 |
| 21740 | 1023 |
| 21741 | 1023 |
| 21742 | 1023 |
| 21743 | 1023 |
| 21744 | 1023 |
| 21745 | 1023 |
| 21746 | 1023 |
| 21747 | 1023 |
| 21748 | 1023 |
| 21749 | 1023 |
| 21750 | 1023 |
| 21751 | 1023 |
| 21752 | 1023 |
| 21753 | 1023 |
| 21754 | 1023 |
| 21755 | 1023 |
| 21756 | 1023 |
| 21757 | 1023 |
| 21758 | 1023 |
| 21759 | 0 |
| 21760 | 0 |
| 21761 | 0 |
| 21762 | 0 |
| 21763 | 0 |
| 21764 | 0 |
| 21765 | 0 |
| 21766 | 0 |
| 21767 | 0 |
| 21768 | 0 |
| 21769 | 0 |
| 21770 | 0 |
| 21771 | 0 |
| 21772 | 0 |
| 21773 | 1023 |
| 21774 | 1023 |
| 21775 | 1023 |
| 21776 | 1023 |
| 21777 | 1023 |
| 21778 | 1023 |
| 21779 | 1023 |
| 21780 | 1023 |
| 21781 | 1023 |
| 21782 | 1023 |
| 21783 | 1023 |
| 21784 | 1023 |
| 21785 | 1023 |
| 21786 | 1023 |
| 21787 | 1023 |
| 21788 | 1023 |
| 21789 | 1023 |
| 21790 | 1023 |
| 21791 | 1023 |
| 21792 | 1023 |
| 21793 | 1023 |
| 21794 | 1023 |
| 21795 | 1023 |
| 21796 | 1023 |
| 21797 | 1023 |
| 21798 | 1023 |
| 21799 | 1023 |
| 21800 | 1023 |
| 21801 | 1023 |
| 21802 | 1023 |
| 21803 | 1023 |
| 21804 | 1023 |
| 21805 | 1023 |
| 21806 | 1023 |
| 21807 | 1023 |
| 21808 | 1023 |
| 21809 | 1023 |
| 21810 | 1023 |
| 21811 | 0 |
| 21812 | 0 |
| 21813 | 0 |
| 21814 | 0 |
| 21815 | 0 |
| 21816 | 0 |
| 21817 | 0 |
| 21818 | 0 |
| 21819 | 0 |
| 21820 | 0 |
| 21821 | 0 |
| 21822 | 0 |
| 21823 | 0 |
| 21824 | 0 |
| 21825 | 1023 |
| 21826 | 1023 |
| 21827 | 1023 |
| 21828 | 1023 |
| 21829 | 1023 |
| 21830 | 1023 |
| 21831 | 1023 |
| 21832 | 1023 |
| 21833 | 1023 |
| 21834 | 1023 |
| 21835 | 1023 |
| 21836 | 1023 |
| 21837 | 1023 |
| 21838 | 1023 |
| 21839 | 1023 |
| 21840 | 1023 |
| 21841 | 1023 |
| 21842 | 1023 |
| 21843 | 1023 |
| 21844 | 1023 |
| 21845 | 1023 |
| 21846 | 1023 |
| 21847 | 1023 |
| 21848 | 1023 |
| 21849 | 1023 |
| 21850 | 1023 |
| 21851 | 1023 |
| 21852 | 1023 |
| 21853 | 1023 |
| 21854 | 1023 |
| 21855 | 1023 |
| 21856 | 1023 |
| 21857 | 1023 |
| 21858 | 1023 |
| 21859 | 1023 |
| 21860 | 1023 |
| 21861 | 1023 |
| 21862 | 0 |
| 21863 | 0 |
| 21864 | 0 |
| 21865 | 0 |
| 21866 | 0 |
| 21867 | 0 |
| 21868 | 0 |
| 21869 | 0 |
| 21870 | 0 |
| 21871 | 0 |
| 21872 | 0 |
| 21873 | 0 |
| 21874 | 0 |
| 21875 | 0 |
| 21876 | 0 |
| 21877 | 1023 |
| 21878 | 1023 |
| 21879 | 1023 |
| 21880 | 1023 |
| 21881 | 1023 |
| 21882 | 1023 |
| 21883 | 1023 |
| 21884 | 1023 |
| 21885 | 1023 |
| 21886 | 1023 |
| 21887 | 1023 |
| 21888 | 1023 |
| 21889 | 1023 |
| 21890 | 1023 |
| 21891 | 1023 |
| 21892 | 1023 |
| 21893 | 1023 |
| 21894 | 1023 |
| 21895 | 1023 |
| 21896 | 1023 |
| 21897 | 1023 |
| 21898 | 1023 |
| 21899 | 1023 |
| 21900 | 1023 |
| 21901 | 1023 |
| 21902 | 1023 |
| 21903 | 1023 |
| 21904 | 1023 |
| 21905 | 1023 |
| 21906 | 1023 |
| 21907 | 1023 |
| 21908 | 1023 |
| 21909 | 1023 |
| 21910 | 1023 |
| 21911 | 1023 |
| 21912 | 1023 |
| 21913 | 1023 |
| 21914 | 0 |
| 21915 | 0 |
| 21916 | 0 |
| 21917 | 0 |
| 21918 | 0 |
| 21919 | 0 |
| 21920 | 0 |
| 21921 | 0 |
| 21922 | 0 |
| 21923 | 0 |
| 21924 | 0 |
| 21925 | 0 |
| 21926 | 0 |
| 21927 | 0 |
| 21928 | 0 |
| 21929 | 1023 |
| 21930 | 1023 |
| 21931 | 1023 |
| 21932 | 1023 |
| 21933 | 1023 |
| 21934 | 1023 |
| 21935 | 1023 |
| 21936 | 1023 |
| 21937 | 1023 |
| 21938 | 1023 |
| 21939 | 1023 |
| 21940 | 1023 |
| 21941 | 1023 |
| 21942 | 1023 |
| 21943 | 1023 |
| 21944 | 1023 |
| 21945 | 1023 |
| 21946 | 1023 |
| 21947 | 1023 |
| 21948 | 1023 |
| 21949 | 1023 |
| 21950 | 1023 |
| 21951 | 1023 |
| 21952 | 1023 |
| 21953 | 1023 |
| 21954 | 1023 |
| 21955 | 1023 |
| 21956 | 1023 |
| 21957 | 1023 |
| 21958 | 1023 |
| 21959 | 1023 |
| 21960 | 1023 |
| 21961 | 1023 |
| 21962 | 1023 |
| 21963 | 1023 |
| 21964 | 1023 |
| 21965 | 1023 |
| 21966 | 1023 |
| 21967 | 0 |
| 21968 | 0 |
| 21969 | 0 |
| 21970 | 0 |
| 21971 | 0 |
| 21972 | 0 |
| 21973 | 0 |
| 21974 | 0 |
| 21975 | 0 |
| 21976 | 0 |
| 21977 | 0 |
| 21978 | 0 |
| 21979 | 0 |
| 21980 | 1023 |
| 21981 | 1023 |
| 21982 | 1023 |
| 21983 | 1023 |
| 21984 | 1023 |
| 21985 | 1023 |
| 21986 | 1023 |
| 21987 | 1023 |
| 21988 | 1023 |
| 21989 | 1023 |
| 21990 | 1023 |
| 21991 | 1023 |
| 21992 | 1023 |
| 21993 | 1023 |
| 21994 | 1023 |
| 21995 | 1023 |
| 21996 | 1023 |
| 21997 | 1023 |
| 21998 | 1023 |
| 21999 | 1023 |
| 22000 | 1023 |
| 22001 | 1023 |
| 22002 | 1023 |
| 22003 | 1023 |
| 22004 | 1023 |
| 22005 | 1023 |
| 22006 | 1023 |
| 22007 | 1023 |
| 22008 | 1023 |
| 22009 | 1023 |
| 22010 | 1023 |
| 22011 | 1023 |
| 22012 | 1023 |
| 22013 | 1023 |
| 22014 | 1023 |
| 22015 | 1023 |
| 22016 | 1023 |
| 22017 | 1023 |
| 22018 | 0 |
| 22019 | 0 |
| 22020 | 0 |
| 22021 | 0 |
| 22022 | 0 |
| 22023 | 0 |
| 22024 | 0 |
| 22025 | 0 |
| 22026 | 0 |
| 22027 | 0 |
| 22028 | 0 |
| 22029 | 0 |
| 22030 | 0 |
| 22031 | 1023 |
| 22032 | 1023 |
| 22033 | 1023 |
| 22034 | 1023 |
| 22035 | 1023 |
| 22036 | 1023 |
| 22037 | 1023 |
| 22038 | 1023 |
| 22039 | 1023 |
| 22040 | 1023 |
| 22041 | 1023 |
| 22042 | 1023 |
| 22043 | 1023 |
| 22044 | 1023 |
| 22045 | 1023 |
| 22046 | 1023 |
| 22047 | 1023 |
| 22048 | 1023 |
| 22049 | 1023 |
| 22050 | 1023 |
| 22051 | 1023 |
| 22052 | 1023 |
| 22053 | 1023 |
| 22054 | 1023 |
| 22055 | 1023 |
| 22056 | 1023 |
| 22057 | 1023 |
| 22058 | 1023 |
| 22059 | 1023 |
| 22060 | 1023 |
| 22061 | 1023 |
| 22062 | 1023 |
| 22063 | 1023 |
| 22064 | 1023 |
| 22065 | 1023 |
| 22066 | 1023 |
| 22067 | 1023 |
| 22068 | 1023 |
| 22069 | 0 |
| 22070 | 0 |
| 22071 | 0 |
| 22072 | 0 |
| 22073 | 0 |
| 22074 | 0 |
| 22075 | 0 |
| 22076 | 0 |
| 22077 | 0 |
| 22078 | 0 |
| 22079 | 0 |
| 22080 | 0 |
| 22081 | 0 |
| 22082 | 1023 |
| 22083 | 1023 |
| 22084 | 1023 |
| 22085 | 1023 |
| 22086 | 1023 |
| 22087 | 1023 |
| 22088 | 1023 |
| 22089 | 1023 |
| 22090 | 1023 |
| 22091 | 1023 |
| 22092 | 1023 |
| 22093 | 1023 |
| 22094 | 1023 |
| 22095 | 1023 |
| 22096 | 1023 |
| 22097 | 1023 |
| 22098 | 1023 |
| 22099 | 1023 |
| 22100 | 1023 |
| 22101 | 1023 |
| 22102 | 1023 |
| 22103 | 1023 |
| 22104 | 1023 |
| 22105 | 1023 |
| 22106 | 1023 |
| 22107 | 1023 |
| 22108 | 1023 |
| 22109 | 1023 |
| 22110 | 1023 |
| 22111 | 1023 |
| 22112 | 1023 |
| 22113 | 1023 |
| 22114 | 1023 |
| 22115 | 1023 |
| 22116 | 1023 |
| 22117 | 1023 |
| 22118 | 1023 |
| 22119 | 1023 |
| 22120 | 0 |
| 22121 | 0 |
| 22122 | 0 |
| 22123 | 0 |
| 22124 | 0 |
| 22125 | 0 |
| 22126 | 0 |
| 22127 | 0 |
| 22128 | 0 |
| 22129 | 0 |
| 22130 | 0 |
| 22131 | 0 |
| 22132 | 0 |
| 22133 | 1023 |
| 22134 | 1023 |
| 22135 | 1023 |
| 22136 | 1023 |
| 22137 | 1023 |
| 22138 | 1023 |
| 22139 | 1023 |
| 22140 | 1023 |
| 22141 | 1023 |
| 22142 | 1023 |
| 22143 | 1023 |
| 22144 | 1023 |
| 22145 | 1023 |
| 22146 | 1023 |
| 22147 | 1023 |
| 22148 | 1023 |
| 22149 | 1023 |
| 22150 | 1023 |
| 22151 | 1023 |
| 22152 | 1023 |
| 22153 | 1023 |
| 22154 | 1023 |
| 22155 | 1023 |
| 22156 | 1023 |
| 22157 | 1023 |
| 22158 | 1023 |
| 22159 | 1023 |
| 22160 | 1023 |
| 22161 | 1023 |
| 22162 | 1023 |
| 22163 | 1023 |
| 22164 | 1023 |
| 22165 | 1023 |
| 22166 | 1023 |
| 22167 | 1023 |
| 22168 | 1023 |
| 22169 | 1023 |
| 22170 | 1023 |
| 22171 | 0 |
| 22172 | 0 |
| 22173 | 0 |
| 22174 | 0 |
| 22175 | 0 |
| 22176 | 0 |
| 22177 | 0 |
| 22178 | 0 |
| 22179 | 0 |
| 22180 | 0 |
| 22181 | 0 |
| 22182 | 0 |
| 22183 | 0 |
| 22184 | 1023 |
| 22185 | 1023 |
| 22186 | 1023 |
| 22187 | 1023 |
| 22188 | 1023 |
| 22189 | 1023 |
| 22190 | 1023 |
| 22191 | 1023 |
| 22192 | 1023 |
| 22193 | 1023 |
| 22194 | 1023 |
| 22195 | 1023 |
| 22196 | 1023 |
| 22197 | 1023 |
| 22198 | 1023 |
| 22199 | 1023 |
| 22200 | 1023 |
| 22201 | 1023 |
| 22202 | 1023 |
| 22203 | 1023 |
| 22204 | 1023 |
| 22205 | 1023 |
| 22206 | 1023 |
| 22207 | 1023 |
| 22208 | 1023 |
| 22209 | 1023 |
| 22210 | 1023 |
| 22211 | 1023 |
| 22212 | 1023 |
| 22213 | 1023 |
| 22214 | 1023 |
| 22215 | 1023 |
| 22216 | 1023 |
| 22217 | 1023 |
| 22218 | 1023 |
| 22219 | 1023 |
| 22220 | 1023 |
| 22221 | 1023 |
| 22222 | 0 |
| 22223 | 0 |
| 22224 | 0 |
| 22225 | 0 |
| 22226 | 0 |
| 22227 | 0 |
| 22228 | 0 |
| 22229 | 0 |
| 22230 | 0 |
| 22231 | 0 |
| 22232 | 0 |
| 22233 | 0 |
| 22234 | 0 |
| 22235 | 1023 |
| 22236 | 1023 |
| 22237 | 1023 |
| 22238 | 1023 |
| 22239 | 1023 |
| 22240 | 1023 |
| 22241 | 1023 |
| 22242 | 1023 |
| 22243 | 1023 |
| 22244 | 1023 |
| 22245 | 1023 |
| 22246 | 1023 |
| 22247 | 1023 |
| 22248 | 1023 |
| 22249 | 1023 |
| 22250 | 1023 |
| 22251 | 1023 |
| 22252 | 1023 |
| 22253 | 1023 |
| 22254 | 1023 |
| 22255 | 1023 |
| 22256 | 1023 |
| 22257 | 1023 |
| 22258 | 1023 |
| 22259 | 1023 |
| 22260 | 1023 |
| 22261 | 1023 |
| 22262 | 1023 |
| 22263 | 1023 |
| 22264 | 1023 |
| 22265 | 1023 |
| 22266 | 1023 |
| 22267 | 1023 |
| 22268 | 1023 |
| 22269 | 1023 |
| 22270 | 1023 |
| 22271 | 1023 |
| 22272 | 1023 |
| 22273 | 0 |
| 22274 | 0 |
| 22275 | 0 |
| 22276 | 0 |
| 22277 | 0 |
| 22278 | 0 |
| 22279 | 0 |
| 22280 | 0 |
| 22281 | 0 |
| 22282 | 0 |
| 22283 | 0 |
| 22284 | 0 |
| 22285 | 0 |
| 22286 | 1023 |
| 22287 | 1023 |
| 22288 | 1023 |
| 22289 | 1023 |
| 22290 | 1023 |
| 22291 | 1023 |
| 22292 | 1023 |
| 22293 | 1023 |
| 22294 | 1023 |
| 22295 | 1023 |
| 22296 | 1023 |
| 22297 | 1023 |
| 22298 | 1023 |
| 22299 | 1023 |
| 22300 | 1023 |
| 22301 | 1023 |
| 22302 | 1023 |
| 22303 | 1023 |
| 22304 | 1023 |
| 22305 | 1023 |
| 22306 | 1023 |
| 22307 | 1023 |
| 22308 | 1023 |
| 22309 | 1023 |
| 22310 | 1023 |
| 22311 | 1023 |
| 22312 | 1023 |
| 22313 | 1023 |
| 22314 | 1023 |
| 22315 | 1023 |
| 22316 | 1023 |
| 22317 | 1023 |
| 22318 | 1023 |
| 22319 | 1023 |
| 22320 | 1023 |
| 22321 | 1023 |
| 22322 | 1023 |
| 22323 | 1023 |
| 22324 | 0 |
| 22325 | 0 |
| 22326 | 0 |
| 22327 | 1 |
| 22328 | 0 |
| 22329 | 0 |
| 22330 | 0 |
| 22331 | 0 |
| 22332 | 0 |
| 22333 | 0 |
| 22334 | 0 |
| 22335 | 0 |
| 22336 | 0 |
| 22337 | 1023 |
| 22338 | 1023 |
| 22339 | 1023 |
| 22340 | 1023 |
| 22341 | 1023 |
| 22342 | 1023 |
| 22343 | 1023 |
| 22344 | 1023 |
| 22345 | 1023 |
| 22346 | 1023 |
| 22347 | 1023 |
| 22348 | 1023 |
| 22349 | 1023 |
| 22350 | 1023 |
| 22351 | 1023 |
| 22352 | 1023 |
| 22353 | 1023 |
| 22354 | 1023 |
| 22355 | 1023 |
| 22356 | 1023 |
| 22357 | 1023 |
| 22358 | 1023 |
| 22359 | 1023 |
| 22360 | 1023 |
| 22361 | 1023 |
| 22362 | 1023 |
| 22363 | 1023 |
| 22364 | 1023 |
| 22365 | 1023 |
| 22366 | 1023 |
| 22367 | 1023 |
| 22368 | 1023 |
| 22369 | 1023 |
| 22370 | 1023 |
| 22371 | 1023 |
| 22372 | 1023 |
| 22373 | 1023 |
| 22374 | 1023 |
| 22375 | 0 |
| 22376 | 0 |
| 22377 | 0 |
| 22378 | 0 |
| 22379 | 0 |
| 22380 | 0 |
| 22381 | 0 |
| 22382 | 0 |
| 22383 | 0 |
| 22384 | 0 |
| 22385 | 0 |
| 22386 | 0 |
| 22387 | 0 |
| 22388 | 0 |
| 22389 | 1023 |
| 22390 | 1023 |
| 22391 | 1023 |
| 22392 | 1023 |
| 22393 | 1023 |
| 22394 | 1023 |
| 22395 | 1023 |
| 22396 | 1023 |
| 22397 | 1023 |
| 22398 | 1023 |
| 22399 | 1023 |
| 22400 | 1023 |
| 22401 | 1023 |
| 22402 | 1023 |
| 22403 | 1023 |
| 22404 | 1023 |
| 22405 | 1023 |
| 22406 | 1023 |
| 22407 | 1023 |
| 22408 | 1023 |
| 22409 | 1023 |
| 22410 | 1023 |
| 22411 | 1023 |
| 22412 | 1023 |
| 22413 | 1023 |
| 22414 | 1023 |
| 22415 | 1023 |
| 22416 | 1023 |
| 22417 | 1023 |
| 22418 | 1023 |
| 22419 | 1023 |
| 22420 | 1023 |
| 22421 | 1023 |
| 22422 | 1023 |
| 22423 | 1023 |
| 22424 | 1023 |
| 22425 | 1023 |
| 22426 | 0 |
| 22427 | 0 |
| 22428 | 0 |
| 22429 | 0 |
| 22430 | 0 |
| 22431 | 0 |
| 22432 | 0 |
| 22433 | 0 |
| 22434 | 0 |
| 22435 | 0 |
| 22436 | 0 |
| 22437 | 0 |
| 22438 | 0 |
| 22439 | 0 |
| 22440 | 0 |
| 22441 | 1023 |
| 22442 | 1023 |
| 22443 | 1023 |
| 22444 | 1023 |
| 22445 | 1023 |
| 22446 | 1023 |
| 22447 | 1023 |
| 22448 | 1023 |
| 22449 | 1023 |
| 22450 | 1023 |
| 22451 | 1023 |
| 22452 | 1023 |
| 22453 | 1023 |
| 22454 | 1023 |
| 22455 | 1023 |
| 22456 | 1023 |
| 22457 | 1023 |
| 22458 | 1023 |
| 22459 | 1023 |
| 22460 | 1023 |
| 22461 | 1023 |
| 22462 | 1023 |
| 22463 | 1023 |
| 22464 | 1023 |
| 22465 | 1023 |
| 22466 | 1023 |
| 22467 | 1023 |
| 22468 | 1023 |
| 22469 | 1023 |
| 22470 | 1023 |
| 22471 | 1023 |
| 22472 | 1023 |
| 22473 | 1023 |
| 22474 | 1023 |
| 22475 | 1023 |
| 22476 | 1023 |
| 22477 | 1023 |
| 22478 | 0 |
| 22479 | 0 |
| 22480 | 0 |
| 22481 | 0 |
| 22482 | 0 |
| 22483 | 0 |
| 22484 | 0 |
| 22485 | 0 |
| 22486 | 0 |
| 22487 | 0 |
| 22488 | 0 |
| 22489 | 0 |
| 22490 | 0 |
| 22491 | 0 |
| 22492 | 0 |
| 22493 | 1023 |
| 22494 | 1023 |
| 22495 | 1023 |
| 22496 | 1023 |
| 22497 | 1023 |
| 22498 | 1023 |
| 22499 | 1023 |
| 22500 | 1023 |
| 22501 | 1023 |
| 22502 | 1023 |
| 22503 | 1023 |
| 22504 | 1023 |
| 22505 | 1023 |
| 22506 | 1023 |
| 22507 | 1023 |
| 22508 | 1023 |
| 22509 | 1023 |
| 22510 | 1023 |
| 22511 | 1023 |
| 22512 | 1023 |
| 22513 | 1023 |
| 22514 | 1023 |
| 22515 | 1023 |
| 22516 | 1023 |
| 22517 | 1023 |
| 22518 | 1023 |
| 22519 | 1023 |
| 22520 | 1023 |
| 22521 | 1023 |
| 22522 | 1023 |
| 22523 | 1023 |
| 22524 | 1023 |
| 22525 | 1023 |
| 22526 | 1023 |
| 22527 | 1023 |
| 22528 | 1023 |
| 22529 | 1023 |
| 22530 | 0 |
| 22531 | 0 |
| 22532 | 0 |
| 22533 | 0 |
| 22534 | 0 |
| 22535 | 0 |
| 22536 | 0 |
| 22537 | 0 |
| 22538 | 0 |
| 22539 | 0 |
| 22540 | 0 |
| 22541 | 0 |
| 22542 | 0 |
| 22543 | 0 |
| 22544 | 0 |
| 22545 | 1023 |
| 22546 | 1023 |
| 22547 | 1023 |
| 22548 | 1023 |
| 22549 | 1023 |
| 22550 | 1023 |
| 22551 | 1023 |
| 22552 | 1023 |
| 22553 | 1023 |
| 22554 | 1023 |
| 22555 | 1023 |
| 22556 | 1023 |
| 22557 | 1023 |
| 22558 | 1023 |
| 22559 | 1023 |
| 22560 | 1023 |
| 22561 | 1023 |
| 22562 | 1023 |
| 22563 | 1023 |
| 22564 | 1023 |
| 22565 | 1023 |
| 22566 | 1023 |
| 22567 | 1023 |
| 22568 | 1023 |
| 22569 | 1023 |
| 22570 | 1023 |
| 22571 | 1023 |
| 22572 | 1023 |
| 22573 | 1023 |
| 22574 | 1023 |
| 22575 | 1023 |
| 22576 | 1023 |
| 22577 | 1023 |
| 22578 | 1023 |
| 22579 | 1023 |
| 22580 | 1023 |
| 22581 | 1023 |
| 22582 | 1023 |
| 22583 | 0 |
| 22584 | 0 |
| 22585 | 0 |
| 22586 | 0 |
| 22587 | 0 |
| 22588 | 0 |
| 22589 | 0 |
| 22590 | 0 |
| 22591 | 0 |
| 22592 | 0 |
| 22593 | 0 |
| 22594 | 0 |
| 22595 | 0 |
| 22596 | 1023 |
| 22597 | 1023 |
| 22598 | 1023 |
| 22599 | 1023 |
| 22600 | 1023 |
| 22601 | 1023 |
| 22602 | 1023 |
| 22603 | 1023 |
| 22604 | 1023 |
| 22605 | 1023 |
| 22606 | 1023 |
| 22607 | 1023 |
| 22608 | 1023 |
| 22609 | 1023 |
| 22610 | 1023 |
| 22611 | 1023 |
| 22612 | 1023 |
| 22613 | 1023 |
| 22614 | 1023 |
| 22615 | 1023 |
| 22616 | 1023 |
| 22617 | 1023 |
| 22618 | 1023 |
| 22619 | 1023 |
| 22620 | 1023 |
| 22621 | 1023 |
| 22622 | 1023 |
| 22623 | 1023 |
| 22624 | 1023 |
| 22625 | 1023 |
| 22626 | 1023 |
| 22627 | 1023 |
| 22628 | 1023 |
| 22629 | 1023 |
| 22630 | 1023 |
| 22631 | 1023 |
| 22632 | 1023 |
| 22633 | 1023 |
| 22634 | 0 |
| 22635 | 0 |
| 22636 | 0 |
| 22637 | 0 |
| 22638 | 0 |
| 22639 | 0 |
| 22640 | 0 |
| 22641 | 0 |
| 22642 | 0 |
| 22643 | 0 |
| 22644 | 0 |
| 22645 | 0 |
| 22646 | 0 |
| 22647 | 1023 |
| 22648 | 1023 |
| 22649 | 1023 |
| 22650 | 1023 |
| 22651 | 1023 |
| 22652 | 1023 |
| 22653 | 1023 |
| 22654 | 1023 |
| 22655 | 1023 |
| 22656 | 1023 |
| 22657 | 1023 |
| 22658 | 1023 |
| 22659 | 1023 |
| 22660 | 1023 |
| 22661 | 1023 |
| 22662 | 1023 |
| 22663 | 1023 |
| 22664 | 1023 |
| 22665 | 1023 |
| 22666 | 1023 |
| 22667 | 1023 |
| 22668 | 1023 |
| 22669 | 1023 |
| 22670 | 1023 |
| 22671 | 1023 |
| 22672 | 1023 |
| 22673 | 1023 |
| 22674 | 1023 |
| 22675 | 1023 |
| 22676 | 1023 |
| 22677 | 1023 |
| 22678 | 1023 |
| 22679 | 1023 |
| 22680 | 1023 |
| 22681 | 1023 |
| 22682 | 1023 |
| 22683 | 1023 |
| 22684 | 1023 |
| 22685 | 0 |
| 22686 | 0 |
| 22687 | 0 |
| 22688 | 0 |
| 22689 | 0 |
| 22690 | 0 |
| 22691 | 0 |
| 22692 | 0 |
| 22693 | 0 |
| 22694 | 0 |
| 22695 | 0 |
| 22696 | 0 |
| 22697 | 0 |
| 22698 | 1023 |
| 22699 | 1023 |
| 22700 | 1023 |
| 22701 | 1023 |
| 22702 | 1023 |
| 22703 | 1023 |
| 22704 | 1023 |
| 22705 | 1023 |
| 22706 | 1023 |
| 22707 | 1023 |
| 22708 | 1023 |
| 22709 | 1023 |
| 22710 | 1023 |
| 22711 | 1023 |
| 22712 | 1023 |
| 22713 | 1023 |
| 22714 | 1023 |
| 22715 | 1023 |
| 22716 | 1023 |
| 22717 | 1023 |
| 22718 | 1023 |
| 22719 | 1023 |
| 22720 | 1023 |
| 22721 | 1023 |
| 22722 | 1023 |
| 22723 | 1023 |
| 22724 | 1023 |
| 22725 | 1023 |
| 22726 | 1023 |
| 22727 | 1023 |
| 22728 | 1023 |
| 22729 | 1023 |
| 22730 | 1023 |
| 22731 | 1023 |
| 22732 | 1023 |
| 22733 | 1023 |
| 22734 | 1023 |
| 22735 | 1023 |
| 22736 | 0 |
| 22737 | 0 |
| 22738 | 0 |
| 22739 | 0 |
| 22740 | 0 |
| 22741 | 0 |
| 22742 | 0 |
| 22743 | 0 |
| 22744 | 0 |
| 22745 | 0 |
| 22746 | 0 |
| 22747 | 0 |
| 22748 | 0 |
| 22749 | 1023 |
| 22750 | 1023 |
| 22751 | 1023 |
| 22752 | 1023 |
| 22753 | 1023 |
| 22754 | 1023 |
| 22755 | 1023 |
| 22756 | 1023 |
| 22757 | 1023 |
| 22758 | 1023 |
| 22759 | 1023 |
| 22760 | 1023 |
| 22761 | 1023 |
| 22762 | 1023 |
| 22763 | 1023 |
| 22764 | 1023 |
| 22765 | 1023 |
| 22766 | 1023 |
| 22767 | 1023 |
| 22768 | 1023 |
| 22769 | 1023 |
| 22770 | 1023 |
| 22771 | 1023 |
| 22772 | 1023 |
| 22773 | 1023 |
| 22774 | 1023 |
| 22775 | 1023 |
| 22776 | 1023 |
| 22777 | 1023 |
| 22778 | 1023 |
| 22779 | 1023 |
| 22780 | 1023 |
| 22781 | 1023 |
| 22782 | 1023 |
| 22783 | 1023 |
| 22784 | 1023 |
| 22785 | 1023 |
| 22786 | 1023 |
| 22787 | 0 |
| 22788 | 0 |
| 22789 | 0 |
| 22790 | 0 |
| 22791 | 0 |
| 22792 | 0 |
| 22793 | 0 |
| 22794 | 0 |
| 22795 | 0 |
| 22796 | 0 |
| 22797 | 0 |
| 22798 | 0 |
| 22799 | 0 |
| 22800 | 1023 |
| 22801 | 1023 |
| 22802 | 1023 |
| 22803 | 1023 |
| 22804 | 1023 |
| 22805 | 1023 |
| 22806 | 1023 |
| 22807 | 1023 |
| 22808 | 1023 |
| 22809 | 1023 |
| 22810 | 1023 |
| 22811 | 1023 |
| 22812 | 1023 |
| 22813 | 1023 |
| 22814 | 1023 |
| 22815 | 1023 |
| 22816 | 1023 |
| 22817 | 1023 |
| 22818 | 1023 |
| 22819 | 1023 |
| 22820 | 1023 |
| 22821 | 1023 |
| 22822 | 1023 |
| 22823 | 1023 |
| 22824 | 1023 |
| 22825 | 1023 |
| 22826 | 1023 |
| 22827 | 1023 |
| 22828 | 1023 |
| 22829 | 1023 |
| 22830 | 1023 |
| 22831 | 1023 |
| 22832 | 1023 |
| 22833 | 1023 |
| 22834 | 1023 |
| 22835 | 1023 |
| 22836 | 1023 |
| 22837 | 1023 |
| 22838 | 0 |
| 22839 | 0 |
| 22840 | 0 |
| 22841 | 0 |
| 22842 | 0 |
| 22843 | 0 |
| 22844 | 0 |
| 22845 | 0 |
| 22846 | 0 |
| 22847 | 0 |
| 22848 | 0 |
| 22849 | 0 |
| 22850 | 0 |
| 22851 | 1023 |
| 22852 | 1023 |
| 22853 | 1023 |
| 22854 | 1023 |
| 22855 | 1023 |
| 22856 | 1023 |
| 22857 | 1023 |
| 22858 | 1023 |
| 22859 | 1023 |
| 22860 | 1023 |
| 22861 | 1023 |
| 22862 | 1023 |
| 22863 | 1023 |
| 22864 | 1023 |
| 22865 | 1023 |
| 22866 | 1023 |
| 22867 | 1023 |
| 22868 | 1023 |
| 22869 | 1023 |
| 22870 | 1023 |
| 22871 | 1023 |
| 22872 | 1023 |
| 22873 | 1023 |
| 22874 | 1023 |
| 22875 | 1023 |
| 22876 | 1023 |
| 22877 | 1023 |
| 22878 | 1023 |
| 22879 | 1023 |
| 22880 | 1023 |
| 22881 | 1023 |
| 22882 | 1023 |
| 22883 | 1023 |
| 22884 | 1023 |
| 22885 | 1023 |
| 22886 | 1023 |
| 22887 | 1023 |
| 22888 | 1023 |
| 22889 | 0 |
| 22890 | 0 |
| 22891 | 0 |
| 22892 | 0 |
| 22893 | 0 |
| 22894 | 1 |
| 22895 | 0 |
| 22896 | 0 |
| 22897 | 0 |
| 22898 | 0 |
| 22899 | 0 |
| 22900 | 0 |
| 22901 | 0 |
| 22902 | 1023 |
| 22903 | 1023 |
| 22904 | 1023 |
| 22905 | 1023 |
| 22906 | 1023 |
| 22907 | 1023 |
| 22908 | 1023 |
| 22909 | 1023 |
| 22910 | 1023 |
| 22911 | 1023 |
| 22912 | 1023 |
| 22913 | 1023 |
| 22914 | 1023 |
| 22915 | 1023 |
| 22916 | 1023 |
| 22917 | 1023 |
| 22918 | 1023 |
| 22919 | 1023 |
| 22920 | 1023 |
| 22921 | 1023 |
| 22922 | 1023 |
| 22923 | 1023 |
| 22924 | 1023 |
| 22925 | 1023 |
| 22926 | 1023 |
| 22927 | 1023 |
| 22928 | 1023 |
| 22929 | 1023 |
| 22930 | 1023 |
| 22931 | 1023 |
| 22932 | 1023 |
| 22933 | 1023 |
| 22934 | 1023 |
| 22935 | 1023 |
| 22936 | 1023 |
| 22937 | 1023 |
| 22938 | 1023 |
| 22939 | 1023 |
| 22940 | 0 |
| 22941 | 0 |
| 22942 | 0 |
| 22943 | 0 |
| 22944 | 0 |
| 22945 | 0 |
| 22946 | 0 |
| 22947 | 0 |
| 22948 | 0 |
| 22949 | 0 |
| 22950 | 0 |
| 22951 | 0 |
| 22952 | 0 |
| 22953 | 0 |
| 22954 | 1023 |
| 22955 | 1023 |
| 22956 | 1023 |
| 22957 | 1023 |
| 22958 | 1023 |
| 22959 | 1023 |
| 22960 | 1023 |
| 22961 | 1023 |
| 22962 | 1023 |
| 22963 | 1023 |
| 22964 | 1023 |
| 22965 | 1023 |
| 22966 | 1023 |
| 22967 | 1023 |
| 22968 | 1023 |
| 22969 | 1023 |
| 22970 | 1023 |
| 22971 | 1023 |
| 22972 | 1023 |
| 22973 | 1023 |
| 22974 | 1023 |
| 22975 | 1023 |
| 22976 | 1023 |
| 22977 | 1023 |
| 22978 | 1023 |
| 22979 | 1023 |
| 22980 | 1023 |
| 22981 | 1023 |
| 22982 | 1023 |
| 22983 | 1023 |
| 22984 | 1023 |
| 22985 | 1023 |
| 22986 | 1023 |
| 22987 | 1023 |
| 22988 | 1023 |
| 22989 | 1023 |
| 22990 | 1023 |
| 22991 | 0 |
| 22992 | 0 |
| 22993 | 0 |
| 22994 | 0 |
| 22995 | 0 |
| 22996 | 0 |
| 22997 | 0 |
| 22998 | 0 |
| 22999 | 0 |
| 23000 | 0 |
| 23001 | 0 |
| 23002 | 0 |
| 23003 | 0 |
| 23004 | 0 |
| 23005 | 1023 |
| 23006 | 1023 |
| 23007 | 1023 |
| 23008 | 1023 |
| 23009 | 1023 |
| 23010 | 1023 |
| 23011 | 1023 |
| 23012 | 1023 |
| 23013 | 1023 |
| 23014 | 1023 |
| 23015 | 1023 |
| 23016 | 1023 |
| 23017 | 1023 |
| 23018 | 1023 |
| 23019 | 1023 |
| 23020 | 1023 |
| 23021 | 1023 |
| 23022 | 1023 |
| 23023 | 1023 |
| 23024 | 1023 |
| 23025 | 1023 |
| 23026 | 1023 |
| 23027 | 1023 |
| 23028 | 1023 |
| 23029 | 1023 |
| 23030 | 1023 |
| 23031 | 1023 |
| 23032 | 1023 |
| 23033 | 1023 |
| 23034 | 1023 |
| 23035 | 1023 |
| 23036 | 1023 |
| 23037 | 1023 |
| 23038 | 1023 |
| 23039 | 1023 |
| 23040 | 1023 |
| 23041 | 1023 |
| 23042 | 1023 |
| 23043 | 0 |
| 23044 | 0 |
| 23045 | 0 |
| 23046 | 0 |
| 23047 | 0 |
| 23048 | 0 |
| 23049 | 0 |
| 23050 | 0 |
| 23051 | 0 |
| 23052 | 0 |
| 23053 | 0 |
| 23054 | 0 |
| 23055 | 0 |
| 23056 | 0 |
| 23057 | 1023 |
| 23058 | 1023 |
| 23059 | 1023 |
| 23060 | 1023 |
| 23061 | 1023 |
| 23062 | 1023 |
| 23063 | 1023 |
| 23064 | 1023 |
| 23065 | 1023 |
| 23066 | 1023 |
| 23067 | 1023 |
| 23068 | 1023 |
| 23069 | 1023 |
| 23070 | 1023 |
| 23071 | 1023 |
| 23072 | 1023 |
| 23073 | 1023 |
| 23074 | 1023 |
| 23075 | 1023 |
| 23076 | 1023 |
| 23077 | 1023 |
| 23078 | 1023 |
| 23079 | 1023 |
| 23080 | 1023 |
| 23081 | 1023 |
| 23082 | 1023 |
| 23083 | 1023 |
| 23084 | 1023 |
| 23085 | 1023 |
| 23086 | 1023 |
| 23087 | 1023 |
| 23088 | 1023 |
| 23089 | 1023 |
| 23090 | 1023 |
| 23091 | 1023 |
| 23092 | 1023 |
| 23093 | 1023 |
| 23094 | 0 |
| 23095 | 0 |
| 23096 | 0 |
| 23097 | 0 |
| 23098 | 0 |
| 23099 | 0 |
| 23100 | 0 |
| 23101 | 0 |
| 23102 | 0 |
| 23103 | 0 |
| 23104 | 0 |
| 23105 | 0 |
| 23106 | 0 |
| 23107 | 0 |
| 23108 | 0 |
| 23109 | 1023 |
| 23110 | 1023 |
| 23111 | 1023 |
| 23112 | 1023 |
| 23113 | 1023 |
| 23114 | 1023 |
| 23115 | 1023 |
| 23116 | 1023 |
| 23117 | 1023 |
| 23118 | 1023 |
| 23119 | 1023 |
| 23120 | 1023 |
| 23121 | 1023 |
| 23122 | 1023 |
| 23123 | 1023 |
| 23124 | 1023 |
| 23125 | 1023 |
| 23126 | 1023 |
| 23127 | 1023 |
| 23128 | 1023 |
| 23129 | 1023 |
| 23130 | 1023 |
| 23131 | 1023 |
| 23132 | 1023 |
| 23133 | 1023 |
| 23134 | 1023 |
| 23135 | 1023 |
| 23136 | 1023 |
| 23137 | 1023 |
| 23138 | 1023 |
| 23139 | 1023 |
| 23140 | 1023 |
| 23141 | 1023 |
| 23142 | 1023 |
| 23143 | 1023 |
| 23144 | 1023 |
| 23145 | 1023 |
| 23146 | 0 |
| 23147 | 0 |
| 23148 | 0 |
| 23149 | 0 |
| 23150 | 0 |
| 23151 | 0 |
| 23152 | 0 |
| 23153 | 0 |
| 23154 | 0 |
| 23155 | 0 |
| 23156 | 0 |
| 23157 | 0 |
| 23158 | 0 |
| 23159 | 0 |
| 23160 | 0 |
| 23161 | 1023 |
| 23162 | 1023 |
| 23163 | 1023 |
| 23164 | 1023 |
| 23165 | 1023 |
| 23166 | 1023 |
| 23167 | 1023 |
| 23168 | 1023 |
| 23169 | 1023 |
| 23170 | 1023 |
| 23171 | 1023 |
| 23172 | 1023 |
| 23173 | 1023 |
| 23174 | 1023 |
| 23175 | 1023 |
| 23176 | 1023 |
| 23177 | 1023 |
| 23178 | 1023 |
| 23179 | 1023 |
| 23180 | 1023 |
| 23181 | 1023 |
| 23182 | 1023 |
| 23183 | 1023 |
| 23184 | 1023 |
| 23185 | 1023 |
| 23186 | 1023 |
| 23187 | 1023 |
| 23188 | 1023 |
| 23189 | 1023 |
| 23190 | 1023 |
| 23191 | 1023 |
| 23192 | 1023 |
| 23193 | 1023 |
| 23194 | 1023 |
| 23195 | 1023 |
| 23196 | 1023 |
| 23197 | 1023 |
| 23198 | 1023 |
| 23199 | 0 |
| 23200 | 0 |
| 23201 | 0 |
| 23202 | 0 |
| 23203 | 0 |
| 23204 | 0 |
| 23205 | 0 |
| 23206 | 0 |
| 23207 | 0 |
| 23208 | 0 |
| 23209 | 0 |
| 23210 | 0 |
| 23211 | 0 |
| 23212 | 1023 |
| 23213 | 1023 |
| 23214 | 1023 |
| 23215 | 1023 |
| 23216 | 1023 |
| 23217 | 1023 |
| 23218 | 1023 |
| 23219 | 1023 |
| 23220 | 1023 |
| 23221 | 1023 |
| 23222 | 1023 |
| 23223 | 1023 |
| 23224 | 1023 |
| 23225 | 1023 |
| 23226 | 1023 |
| 23227 | 1023 |
| 23228 | 1023 |
| 23229 | 1023 |
| 23230 | 1023 |
| 23231 | 1023 |
| 23232 | 1023 |
| 23233 | 1023 |
| 23234 | 1023 |
| 23235 | 1023 |
| 23236 | 1023 |
| 23237 | 1023 |
| 23238 | 1023 |
| 23239 | 1023 |
| 23240 | 1023 |
| 23241 | 1023 |
| 23242 | 1023 |
| 23243 | 1023 |
| 23244 | 1023 |
| 23245 | 1023 |
| 23246 | 1023 |
| 23247 | 1023 |
| 23248 | 1023 |
| 23249 | 1023 |
| 23250 | 0 |
| 23251 | 0 |
| 23252 | 0 |
| 23253 | 0 |
| 23254 | 0 |
| 23255 | 0 |
| 23256 | 0 |
| 23257 | 0 |
| 23258 | 0 |
| 23259 | 0 |
| 23260 | 0 |
| 23261 | 0 |
| 23262 | 0 |
| 23263 | 1023 |
| 23264 | 1023 |
| 23265 | 1023 |
| 23266 | 1023 |
| 23267 | 1023 |
| 23268 | 1023 |
| 23269 | 1023 |
| 23270 | 1023 |
| 23271 | 1023 |
| 23272 | 1023 |
| 23273 | 1023 |
| 23274 | 1023 |
| 23275 | 1023 |
| 23276 | 1023 |
| 23277 | 1023 |
| 23278 | 1023 |
| 23279 | 1023 |
| 23280 | 1023 |
| 23281 | 1023 |
| 23282 | 1023 |
| 23283 | 1023 |
| 23284 | 1023 |
| 23285 | 1023 |
| 23286 | 1023 |
| 23287 | 1023 |
| 23288 | 1023 |
| 23289 | 1023 |
| 23290 | 1023 |
| 23291 | 1023 |
| 23292 | 1023 |
| 23293 | 1023 |
| 23294 | 1023 |
| 23295 | 1023 |
| 23296 | 1023 |
| 23297 | 1023 |
| 23298 | 1023 |
| 23299 | 1023 |
| 23300 | 1023 |
| 23301 | 0 |
| 23302 | 0 |
| 23303 | 0 |
| 23304 | 0 |
| 23305 | 0 |
| 23306 | 0 |
| 23307 | 0 |
| 23308 | 1 |
| 23309 | 0 |
| 23310 | 1 |
| 23311 | 0 |
| 23312 | 0 |
| 23313 | 0 |
| 23314 | 1023 |
| 23315 | 1023 |
| 23316 | 1023 |
| 23317 | 1023 |
| 23318 | 1023 |
| 23319 | 1023 |
| 23320 | 1023 |
| 23321 | 1023 |
| 23322 | 1023 |
| 23323 | 1023 |
| 23324 | 1023 |
| 23325 | 1023 |
| 23326 | 1023 |
| 23327 | 1023 |
| 23328 | 1023 |
| 23329 | 1023 |
| 23330 | 1023 |
| 23331 | 1023 |
| 23332 | 1023 |
| 23333 | 1023 |
| 23334 | 1023 |
| 23335 | 1023 |
| 23336 | 1023 |
| 23337 | 1023 |
| 23338 | 1023 |
| 23339 | 1023 |
| 23340 | 1023 |
| 23341 | 1023 |
| 23342 | 1023 |
| 23343 | 1023 |
| 23344 | 1023 |
| 23345 | 1023 |
| 23346 | 1023 |
| 23347 | 1023 |
| 23348 | 1023 |
| 23349 | 1023 |
| 23350 | 1023 |
| 23351 | 1023 |
| 23352 | 0 |
| 23353 | 0 |
| 23354 | 0 |
| 23355 | 0 |
| 23356 | 0 |
| 23357 | 0 |
| 23358 | 0 |
| 23359 | 0 |
| 23360 | 0 |
| 23361 | 0 |
| 23362 | 0 |
| 23363 | 0 |
| 23364 | 0 |
| 23365 | 1023 |
| 23366 | 1023 |
| 23367 | 1023 |
| 23368 | 1023 |
| 23369 | 1023 |
| 23370 | 1023 |
| 23371 | 1023 |
| 23372 | 1023 |
| 23373 | 1023 |
| 23374 | 1023 |
| 23375 | 1023 |
| 23376 | 1023 |
| 23377 | 1023 |
| 23378 | 1023 |
| 23379 | 1023 |
| 23380 | 1023 |
| 23381 | 1023 |
| 23382 | 1023 |
| 23383 | 1023 |
| 23384 | 1023 |
| 23385 | 1023 |
| 23386 | 1023 |
| 23387 | 1023 |
| 23388 | 1023 |
| 23389 | 1023 |
| 23390 | 1023 |
| 23391 | 1023 |
| 23392 | 1023 |
| 23393 | 1023 |
| 23394 | 1023 |
| 23395 | 1023 |
| 23396 | 1023 |
| 23397 | 1023 |
| 23398 | 1023 |
| 23399 | 1023 |
| 23400 | 1023 |
| 23401 | 1023 |
| 23402 | 1023 |
| 23403 | 0 |
| 23404 | 0 |
| 23405 | 0 |
| 23406 | 0 |
| 23407 | 0 |
| 23408 | 0 |
| 23409 | 0 |
| 23410 | 0 |
| 23411 | 0 |
| 23412 | 0 |
| 23413 | 0 |
| 23414 | 0 |
| 23415 | 0 |
| 23416 | 1023 |
| 23417 | 1023 |
| 23418 | 1023 |
| 23419 | 1023 |
| 23420 | 1023 |
| 23421 | 1023 |
| 23422 | 1023 |
| 23423 | 1023 |
| 23424 | 1023 |
| 23425 | 1023 |
| 23426 | 1023 |
| 23427 | 1023 |
| 23428 | 1023 |
| 23429 | 1023 |
| 23430 | 1023 |
| 23431 | 1023 |
| 23432 | 1023 |
| 23433 | 1023 |
| 23434 | 1023 |
| 23435 | 1023 |
| 23436 | 1023 |
| 23437 | 1023 |
| 23438 | 1023 |
| 23439 | 1023 |
| 23440 | 1023 |
| 23441 | 1023 |
| 23442 | 1023 |
| 23443 | 1023 |
| 23444 | 1023 |
| 23445 | 1023 |
| 23446 | 1023 |
| 23447 | 1023 |
| 23448 | 1023 |
| 23449 | 1023 |
| 23450 | 1023 |
| 23451 | 1023 |
| 23452 | 1023 |
| 23453 | 1023 |
| 23454 | 0 |
| 23455 | 0 |
| 23456 | 0 |
| 23457 | 0 |
| 23458 | 0 |
| 23459 | 0 |
| 23460 | 0 |
| 23461 | 0 |
| 23462 | 0 |
| 23463 | 0 |
| 23464 | 0 |
| 23465 | 0 |
| 23466 | 0 |
| 23467 | 1023 |
| 23468 | 1023 |
| 23469 | 1023 |
| 23470 | 1023 |
| 23471 | 1023 |
| 23472 | 1023 |
| 23473 | 1023 |
| 23474 | 1023 |
| 23475 | 1023 |
| 23476 | 1023 |
| 23477 | 1023 |
| 23478 | 1023 |
| 23479 | 1023 |
| 23480 | 1023 |
| 23481 | 1023 |
| 23482 | 1023 |
| 23483 | 1023 |
| 23484 | 1023 |
| 23485 | 1023 |
| 23486 | 1023 |
| 23487 | 1023 |
| 23488 | 1023 |
| 23489 | 1023 |
| 23490 | 1023 |
| 23491 | 1023 |
| 23492 | 1023 |
| 23493 | 1023 |
| 23494 | 1023 |
| 23495 | 1023 |
| 23496 | 1023 |
| 23497 | 1023 |
| 23498 | 1023 |
| 23499 | 1023 |
| 23500 | 1023 |
| 23501 | 1023 |
| 23502 | 1023 |
| 23503 | 1023 |
| 23504 | 1023 |
| 23505 | 0 |
| 23506 | 0 |
| 23507 | 0 |
| 23508 | 0 |
| 23509 | 0 |
| 23510 | 1 |
| 23511 | 0 |
| 23512 | 0 |
| 23513 | 0 |
| 23514 | 0 |
| 23515 | 0 |
| 23516 | 0 |
| 23517 | 0 |
| 23518 | 0 |
| 23519 | 1023 |
| 23520 | 1023 |
| 23521 | 1023 |
| 23522 | 1023 |
| 23523 | 1023 |
| 23524 | 1023 |
| 23525 | 1023 |
| 23526 | 1023 |
| 23527 | 1023 |
| 23528 | 1023 |
| 23529 | 1023 |
| 23530 | 1023 |
| 23531 | 1023 |
| 23532 | 1023 |
| 23533 | 1023 |
| 23534 | 1023 |
| 23535 | 1023 |
| 23536 | 1023 |
| 23537 | 1023 |
| 23538 | 1023 |
| 23539 | 1023 |
| 23540 | 1023 |
| 23541 | 1023 |
| 23542 | 1023 |
| 23543 | 1023 |
| 23544 | 1023 |
| 23545 | 1023 |
| 23546 | 1023 |
| 23547 | 1023 |
| 23548 | 1023 |
| 23549 | 1023 |
| 23550 | 1023 |
| 23551 | 1023 |
| 23552 | 1023 |
| 23553 | 1023 |
| 23554 | 1023 |
| 23555 | 1023 |
| 23556 | 0 |
| 23557 | 0 |
| 23558 | 0 |
| 23559 | 0 |
| 23560 | 0 |
| 23561 | 0 |
| 23562 | 0 |
| 23563 | 0 |
| 23564 | 0 |
| 23565 | 0 |
| 23566 | 0 |
| 23567 | 0 |
| 23568 | 0 |
| 23569 | 0 |
| 23570 | 1023 |
| 23571 | 1023 |
| 23572 | 1023 |
| 23573 | 1023 |
| 23574 | 1023 |
| 23575 | 1023 |
| 23576 | 1023 |
| 23577 | 1023 |
| 23578 | 1023 |
| 23579 | 1023 |
| 23580 | 1023 |
| 23581 | 1023 |
| 23582 | 1023 |
| 23583 | 1023 |
| 23584 | 1023 |
| 23585 | 1023 |
| 23586 | 1023 |
| 23587 | 1023 |
| 23588 | 1023 |
| 23589 | 1023 |
| 23590 | 1023 |
| 23591 | 1023 |
| 23592 | 1023 |
| 23593 | 1023 |
| 23594 | 1023 |
| 23595 | 1023 |
| 23596 | 1023 |
| 23597 | 1023 |
| 23598 | 1023 |
| 23599 | 1023 |
| 23600 | 1023 |
| 23601 | 1023 |
| 23602 | 1023 |
| 23603 | 1023 |
| 23604 | 1023 |
| 23605 | 1023 |
| 23606 | 1023 |
| 23607 | 1023 |
| 23608 | 0 |
| 23609 | 0 |
| 23610 | 0 |
| 23611 | 0 |
| 23612 | 0 |
| 23613 | 0 |
| 23614 | 0 |
| 23615 | 0 |
| 23616 | 0 |
| 23617 | 0 |
| 23618 | 0 |
| 23619 | 1 |
| 23620 | 0 |
| 23621 | 0 |
| 23622 | 1023 |
| 23623 | 1023 |
| 23624 | 1023 |
| 23625 | 1023 |
| 23626 | 1023 |
| 23627 | 1023 |
| 23628 | 1023 |
| 23629 | 1023 |
| 23630 | 1023 |
| 23631 | 1023 |
| 23632 | 1023 |
| 23633 | 1023 |
| 23634 | 1023 |
| 23635 | 1023 |
| 23636 | 1023 |
| 23637 | 1023 |
| 23638 | 1023 |
| 23639 | 1023 |
| 23640 | 1023 |
| 23641 | 1023 |
| 23642 | 1023 |
| 23643 | 1023 |
| 23644 | 1023 |
| 23645 | 1023 |
| 23646 | 1023 |
| 23647 | 1023 |
| 23648 | 1023 |
| 23649 | 1023 |
| 23650 | 1023 |
| 23651 | 1023 |
| 23652 | 1023 |
| 23653 | 1023 |
| 23654 | 1023 |
| 23655 | 1023 |
| 23656 | 1023 |
| 23657 | 1023 |
| 23658 | 1023 |
| 23659 | 0 |
| 23660 | 0 |
| 23661 | 0 |
| 23662 | 0 |
| 23663 | 0 |
| 23664 | 0 |
| 23665 | 1 |
| 23666 | 0 |
| 23667 | 0 |
| 23668 | 0 |
| 23669 | 0 |
| 23670 | 0 |
| 23671 | 0 |
| 23672 | 0 |
| 23673 | 0 |
| 23674 | 1023 |
| 23675 | 1023 |
| 23676 | 1023 |
| 23677 | 1023 |
| 23678 | 1023 |
| 23679 | 1023 |
| 23680 | 1023 |
| 23681 | 1023 |
| 23682 | 1023 |
| 23683 | 1023 |
| 23684 | 1023 |
| 23685 | 1023 |
| 23686 | 1023 |
| 23687 | 1023 |
| 23688 | 1023 |
| 23689 | 1023 |
| 23690 | 1023 |
| 23691 | 1023 |
| 23692 | 1023 |
| 23693 | 1023 |
| 23694 | 1023 |
| 23695 | 1023 |
| 23696 | 1023 |
| 23697 | 1023 |
| 23698 | 1023 |
| 23699 | 1023 |
| 23700 | 1023 |
| 23701 | 1023 |
| 23702 | 1023 |
| 23703 | 1023 |
| 23704 | 1023 |
| 23705 | 1023 |
| 23706 | 1023 |
| 23707 | 1023 |
| 23708 | 1023 |
| 23709 | 1023 |
| 23710 | 1023 |
| 23711 | 0 |
| 23712 | 0 |
| 23713 | 0 |
| 23714 | 0 |
| 23715 | 0 |
| 23716 | 0 |
| 23717 | 0 |
| 23718 | 0 |
| 23719 | 0 |
| 23720 | 0 |
| 23721 | 0 |
| 23722 | 0 |
| 23723 | 0 |
| 23724 | 0 |
| 23725 | 0 |
| 23726 | 1023 |
| 23727 | 1023 |
| 23728 | 1023 |
| 23729 | 1023 |
| 23730 | 1023 |
| 23731 | 1023 |
| 23732 | 1023 |
| 23733 | 1023 |
| 23734 | 1023 |
| 23735 | 1023 |
| 23736 | 1023 |
| 23737 | 1023 |
| 23738 | 1023 |
| 23739 | 1023 |
| 23740 | 1023 |
| 23741 | 1023 |
| 23742 | 1023 |
| 23743 | 1023 |
| 23744 | 1023 |
| 23745 | 1023 |
| 23746 | 1023 |
| 23747 | 1023 |
| 23748 | 1023 |
| 23749 | 1023 |
| 23750 | 1023 |
| 23751 | 1023 |
| 23752 | 1023 |
| 23753 | 1023 |
| 23754 | 1023 |
| 23755 | 1023 |
| 23756 | 1023 |
| 23757 | 1023 |
| 23758 | 1023 |
| 23759 | 1023 |
| 23760 | 1023 |
| 23761 | 1023 |
| 23762 | 1023 |
| 23763 | 0 |
| 23764 | 0 |
| 23765 | 0 |
| 23766 | 0 |
| 23767 | 0 |
| 23768 | 0 |
| 23769 | 0 |
| 23770 | 0 |
| 23771 | 0 |
| 23772 | 0 |
| 23773 | 0 |
| 23774 | 0 |
| 23775 | 0 |
| 23776 | 0 |
| 23777 | 0 |
| 23778 | 1023 |
| 23779 | 1023 |
| 23780 | 1023 |
| 23781 | 1023 |
| 23782 | 1023 |
| 23783 | 1023 |
| 23784 | 1023 |
| 23785 | 1023 |
| 23786 | 1023 |
| 23787 | 1023 |
| 23788 | 1023 |
| 23789 | 1023 |
| 23790 | 1023 |
| 23791 | 1023 |
| 23792 | 1023 |
| 23793 | 1023 |
| 23794 | 1023 |
| 23795 | 1023 |
| 23796 | 1023 |
| 23797 | 1023 |
| 23798 | 1023 |
| 23799 | 1023 |
| 23800 | 1023 |
| 23801 | 1023 |
| 23802 | 1023 |
| 23803 | 1023 |
| 23804 | 1023 |
| 23805 | 1023 |
| 23806 | 1023 |
| 23807 | 1023 |
| 23808 | 1023 |
| 23809 | 1023 |
| 23810 | 1023 |
| 23811 | 1023 |
| 23812 | 1023 |
| 23813 | 1023 |
| 23814 | 1023 |
| 23815 | 1023 |
| 23816 | 0 |
| 23817 | 0 |
| 23818 | 0 |
| 23819 | 0 |
| 23820 | 0 |
| 23821 | 0 |
| 23822 | 0 |
| 23823 | 0 |
| 23824 | 0 |
| 23825 | 0 |
| 23826 | 0 |
| 23827 | 0 |
| 23828 | 0 |
| 23829 | 1023 |
| 23830 | 1023 |
| 23831 | 1023 |
| 23832 | 1023 |
| 23833 | 1023 |
| 23834 | 1023 |
| 23835 | 1023 |
| 23836 | 1023 |
| 23837 | 1023 |
| 23838 | 1023 |
| 23839 | 1023 |
| 23840 | 1023 |
| 23841 | 1023 |
| 23842 | 1023 |
| 23843 | 1023 |
| 23844 | 1023 |
| 23845 | 1023 |
| 23846 | 1023 |
| 23847 | 1023 |
| 23848 | 1023 |
| 23849 | 1023 |
| 23850 | 1023 |
| 23851 | 1023 |
| 23852 | 1023 |
| 23853 | 1023 |
| 23854 | 1023 |
| 23855 | 1023 |
| 23856 | 1023 |
| 23857 | 1023 |
| 23858 | 1023 |
| 23859 | 1023 |
| 23860 | 1023 |
| 23861 | 1023 |
| 23862 | 1023 |
| 23863 | 1023 |
| 23864 | 1023 |
| 23865 | 1023 |
| 23866 | 1023 |
| 23867 | 0 |
| 23868 | 0 |
| 23869 | 0 |
| 23870 | 0 |
| 23871 | 0 |
| 23872 | 0 |
| 23873 | 0 |
| 23874 | 0 |
| 23875 | 0 |
| 23876 | 0 |
| 23877 | 0 |
| 23878 | 0 |
| 23879 | 0 |
| 23880 | 1023 |
| 23881 | 1023 |
| 23882 | 1023 |
| 23883 | 1023 |
| 23884 | 1023 |
| 23885 | 1023 |
| 23886 | 1023 |
| 23887 | 1023 |
| 23888 | 1023 |
| 23889 | 1023 |
| 23890 | 1023 |
| 23891 | 1023 |
| 23892 | 1023 |
| 23893 | 1023 |
| 23894 | 1023 |
| 23895 | 1023 |
| 23896 | 1023 |
| 23897 | 1023 |
| 23898 | 1023 |
| 23899 | 1023 |
| 23900 | 1023 |
| 23901 | 1023 |
| 23902 | 1023 |
| 23903 | 1023 |
| 23904 | 1023 |
| 23905 | 1023 |
| 23906 | 1023 |
| 23907 | 1023 |
| 23908 | 1023 |
| 23909 | 1023 |
| 23910 | 1023 |
| 23911 | 1023 |
| 23912 | 1023 |
| 23913 | 1023 |
| 23914 | 1023 |
| 23915 | 1023 |
| 23916 | 1023 |
| 23917 | 1023 |
| 23918 | 0 |
| 23919 | 0 |
| 23920 | 0 |
| 23921 | 0 |
| 23922 | 0 |
| 23923 | 0 |
| 23924 | 0 |
| 23925 | 0 |
| 23926 | 0 |
| 23927 | 0 |
| 23928 | 0 |
| 23929 | 0 |
| 23930 | 0 |
| 23931 | 1023 |
| 23932 | 1023 |
| 23933 | 1023 |
| 23934 | 1023 |
| 23935 | 1023 |
| 23936 | 1023 |
| 23937 | 1023 |
| 23938 | 1023 |
| 23939 | 1023 |
| 23940 | 1023 |
| 23941 | 1023 |
| 23942 | 1023 |
| 23943 | 1023 |
| 23944 | 1023 |
| 23945 | 1023 |
| 23946 | 1023 |
| 23947 | 1023 |
| 23948 | 1023 |
| 23949 | 1023 |
| 23950 | 1023 |
| 23951 | 1023 |
| 23952 | 1023 |
| 23953 | 1023 |
| 23954 | 1023 |
| 23955 | 1023 |
| 23956 | 1023 |
| 23957 | 1023 |
| 23958 | 1023 |
| 23959 | 1023 |
| 23960 | 1023 |
| 23961 | 1023 |
| 23962 | 1023 |
| 23963 | 1023 |
| 23964 | 1023 |
| 23965 | 1023 |
| 23966 | 1023 |
| 23967 | 1023 |
| 23968 | 1023 |
| 23969 | 0 |
| 23970 | 0 |
| 23971 | 0 |
| 23972 | 0 |
| 23973 | 0 |
| 23974 | 0 |
| 23975 | 0 |
| 23976 | 0 |
| 23977 | 0 |
| 23978 | 0 |
| 23979 | 0 |
| 23980 | 0 |
| 23981 | 0 |
| 23982 | 1023 |
| 23983 | 1023 |
| 23984 | 1023 |
| 23985 | 1023 |
| 23986 | 1023 |
| 23987 | 1023 |
| 23988 | 1023 |
| 23989 | 1023 |
| 23990 | 1023 |
| 23991 | 1023 |
| 23992 | 1023 |
| 23993 | 1023 |
| 23994 | 1023 |
| 23995 | 1023 |
| 23996 | 1023 |
| 23997 | 1023 |
| 23998 | 1023 |
| 23999 | 1023 |
| 24000 | 1023 |
| 24001 | 1023 |
| 24002 | 1023 |
| 24003 | 1023 |
| 24004 | 1023 |
| 24005 | 1023 |
| 24006 | 1023 |
| 24007 | 1023 |
| 24008 | 1023 |
| 24009 | 1023 |
| 24010 | 1023 |
| 24011 | 1023 |
| 24012 | 1023 |
| 24013 | 1023 |
| 24014 | 1023 |
| 24015 | 1023 |
| 24016 | 1023 |
| 24017 | 1023 |
| 24018 | 1023 |
| 24019 | 1023 |
| 24020 | 0 |
| 24021 | 0 |
| 24022 | 0 |
| 24023 | 0 |
| 24024 | 0 |
| 24025 | 0 |
| 24026 | 0 |
| 24027 | 0 |
| 24028 | 0 |
| 24029 | 0 |
| 24030 | 0 |
| 24031 | 0 |
| 24032 | 0 |
| 24033 | 1023 |
| 24034 | 1023 |
| 24035 | 1023 |
| 24036 | 1023 |
| 24037 | 1023 |
| 24038 | 1023 |
| 24039 | 1023 |
| 24040 | 1023 |
| 24041 | 1023 |
| 24042 | 1023 |
| 24043 | 1023 |
| 24044 | 1023 |
| 24045 | 1023 |
| 24046 | 1023 |
| 24047 | 1023 |
| 24048 | 1023 |
| 24049 | 1023 |
| 24050 | 1023 |
| 24051 | 1023 |
| 24052 | 1023 |
| 24053 | 1023 |
| 24054 | 1023 |
| 24055 | 1023 |
| 24056 | 1023 |
| 24057 | 1023 |
| 24058 | 1023 |
| 24059 | 1023 |
| 24060 | 1023 |
| 24061 | 1023 |
| 24062 | 1023 |
| 24063 | 1023 |
| 24064 | 1023 |
| 24065 | 1023 |
| 24066 | 1023 |
| 24067 | 1023 |
| 24068 | 1023 |
| 24069 | 1023 |
| 24070 | 1023 |
| 24071 | 0 |
| 24072 | 0 |
| 24073 | 0 |
| 24074 | 0 |
| 24075 | 0 |
| 24076 | 0 |
| 24077 | 0 |
| 24078 | 1 |
| 24079 | 0 |
| 24080 | 0 |
| 24081 | 0 |
| 24082 | 0 |
| 24083 | 0 |
| 24084 | 1023 |
| 24085 | 1023 |
| 24086 | 1023 |
| 24087 | 1023 |
| 24088 | 1023 |
| 24089 | 1023 |
| 24090 | 1023 |
| 24091 | 1023 |
| 24092 | 1023 |
| 24093 | 1023 |
| 24094 | 1023 |
| 24095 | 1023 |
| 24096 | 1023 |
| 24097 | 1023 |
| 24098 | 1023 |
| 24099 | 1023 |
| 24100 | 1023 |
| 24101 | 1023 |
| 24102 | 1023 |
| 24103 | 1023 |
| 24104 | 1023 |
| 24105 | 1023 |
| 24106 | 1023 |
| 24107 | 1023 |
| 24108 | 1023 |
| 24109 | 1023 |
| 24110 | 1023 |
| 24111 | 1023 |
| 24112 | 1023 |
| 24113 | 1023 |
| 24114 | 1023 |
| 24115 | 1023 |
| 24116 | 1023 |
| 24117 | 1023 |
| 24118 | 1023 |
| 24119 | 1023 |
| 24120 | 1023 |
| 24121 | 1023 |
| 24122 | 0 |
| 24123 | 0 |
| 24124 | 0 |
| 24125 | 0 |
| 24126 | 0 |
| 24127 | 0 |
| 24128 | 0 |
| 24129 | 0 |
| 24130 | 0 |
| 24131 | 0 |
| 24132 | 0 |
| 24133 | 0 |
| 24134 | 0 |
| 24135 | 0 |
| 24136 | 1023 |
| 24137 | 1023 |
| 24138 | 1023 |
| 24139 | 1023 |
| 24140 | 1023 |
| 24141 | 1023 |
| 24142 | 1023 |
| 24143 | 1023 |
| 24144 | 1023 |
| 24145 | 1023 |
| 24146 | 1023 |
| 24147 | 1023 |
| 24148 | 1023 |
| 24149 | 1023 |
| 24150 | 1023 |
| 24151 | 1023 |
| 24152 | 1023 |
| 24153 | 1023 |
| 24154 | 1023 |
| 24155 | 1023 |
| 24156 | 1023 |
| 24157 | 1023 |
| 24158 | 1023 |
| 24159 | 1023 |
| 24160 | 1023 |
| 24161 | 1023 |
| 24162 | 1023 |
| 24163 | 1023 |
| 24164 | 1023 |
| 24165 | 1023 |
| 24166 | 1023 |
| 24167 | 1023 |
| 24168 | 1023 |
| 24169 | 1023 |
| 24170 | 1023 |
| 24171 | 1023 |
| 24172 | 1023 |
| 24173 | 0 |
| 24174 | 0 |
| 24175 | 0 |
| 24176 | 0 |
| 24177 | 0 |
| 24178 | 0 |
| 24179 | 1 |
| 24180 | 0 |
| 24181 | 0 |
| 24182 | 0 |
| 24183 | 0 |
| 24184 | 0 |
| 24185 | 0 |
| 24186 | 0 |
| 24187 | 1023 |
| 24188 | 1023 |
| 24189 | 1023 |
| 24190 | 1023 |
| 24191 | 1023 |
| 24192 | 1023 |
| 24193 | 1023 |
| 24194 | 1023 |
| 24195 | 1023 |
| 24196 | 1023 |
| 24197 | 1023 |
| 24198 | 1023 |
| 24199 | 1023 |
| 24200 | 1023 |
| 24201 | 1023 |
| 24202 | 1023 |
| 24203 | 1023 |
| 24204 | 1023 |
| 24205 | 1023 |
| 24206 | 1023 |
| 24207 | 1023 |
| 24208 | 1023 |
| 24209 | 1023 |
| 24210 | 1023 |
| 24211 | 1023 |
| 24212 | 1023 |
| 24213 | 1023 |
| 24214 | 1023 |
| 24215 | 1023 |
| 24216 | 1023 |
| 24217 | 1023 |
| 24218 | 1023 |
| 24219 | 1023 |
| 24220 | 1023 |
| 24221 | 1023 |
| 24222 | 1023 |
| 24223 | 1023 |
| 24224 | 1023 |
| 24225 | 0 |
| 24226 | 0 |
| 24227 | 0 |
| 24228 | 0 |
| 24229 | 0 |
| 24230 | 0 |
| 24231 | 0 |
| 24232 | 0 |
| 24233 | 0 |
| 24234 | 0 |
| 24235 | 0 |
| 24236 | 0 |
| 24237 | 0 |
| 24238 | 0 |
| 24239 | 1023 |
| 24240 | 1023 |
| 24241 | 1023 |
| 24242 | 1023 |
| 24243 | 1023 |
| 24244 | 1023 |
| 24245 | 1023 |
| 24246 | 1023 |
| 24247 | 1023 |
| 24248 | 1023 |
| 24249 | 1023 |
| 24250 | 1023 |
| 24251 | 1023 |
| 24252 | 1023 |
| 24253 | 1023 |
| 24254 | 1023 |
| 24255 | 1023 |
| 24256 | 1023 |
| 24257 | 1023 |
| 24258 | 1023 |
| 24259 | 1023 |
| 24260 | 1023 |
| 24261 | 1023 |
| 24262 | 1023 |
| 24263 | 1023 |
| 24264 | 1023 |
| 24265 | 1023 |
| 24266 | 1023 |
| 24267 | 1023 |
| 24268 | 1023 |
| 24269 | 1023 |
| 24270 | 1023 |
| 24271 | 1023 |
| 24272 | 1023 |
| 24273 | 1023 |
| 24274 | 1023 |
| 24275 | 1023 |
| 24276 | 0 |
| 24277 | 0 |
| 24278 | 0 |
| 24279 | 0 |
| 24280 | 0 |
| 24281 | 0 |
| 24282 | 1 |
| 24283 | 0 |
| 24284 | 0 |
| 24285 | 0 |
| 24286 | 0 |
| 24287 | 0 |
| 24288 | 0 |
| 24289 | 0 |
| 24290 | 1023 |
| 24291 | 1023 |
| 24292 | 1023 |
| 24293 | 1023 |
| 24294 | 1023 |
| 24295 | 1023 |
| 24296 | 1023 |
| 24297 | 1023 |
| 24298 | 1023 |
| 24299 | 1023 |
| 24300 | 1023 |
| 24301 | 1023 |
| 24302 | 1023 |
| 24303 | 1023 |
| 24304 | 1023 |
| 24305 | 1023 |
| 24306 | 1023 |
| 24307 | 1023 |
| 24308 | 1023 |
| 24309 | 1023 |
| 24310 | 1023 |
| 24311 | 1023 |
| 24312 | 1023 |
| 24313 | 1023 |
| 24314 | 1023 |
| 24315 | 1023 |
| 24316 | 1023 |
| 24317 | 1023 |
| 24318 | 1023 |
| 24319 | 1023 |
| 24320 | 1023 |
| 24321 | 1023 |
| 24322 | 1023 |
| 24323 | 1023 |
| 24324 | 1023 |
| 24325 | 1023 |
| 24326 | 1023 |
| 24327 | 1023 |
| 24328 | 0 |
| 24329 | 0 |
| 24330 | 0 |
| 24331 | 0 |
| 24332 | 0 |
| 24333 | 0 |
| 24334 | 0 |
| 24335 | 0 |
| 24336 | 0 |
| 24337 | 0 |
| 24338 | 0 |
| 24339 | 0 |
| 24340 | 0 |
| 24341 | 0 |
| 24342 | 1023 |
| 24343 | 1023 |
| 24344 | 1023 |
| 24345 | 1023 |
| 24346 | 1023 |
| 24347 | 1023 |
| 24348 | 1023 |
| 24349 | 1023 |
| 24350 | 1023 |
| 24351 | 1023 |
| 24352 | 1023 |
| 24353 | 1023 |
| 24354 | 1023 |
| 24355 | 1023 |
| 24356 | 1023 |
| 24357 | 1023 |
| 24358 | 1023 |
| 24359 | 1023 |
| 24360 | 1023 |
| 24361 | 1023 |
| 24362 | 1023 |
| 24363 | 1023 |
| 24364 | 1023 |
| 24365 | 1023 |
| 24366 | 1023 |
| 24367 | 1023 |
| 24368 | 1023 |
| 24369 | 1023 |
| 24370 | 1023 |
| 24371 | 1023 |
| 24372 | 1023 |
| 24373 | 1023 |
| 24374 | 1023 |
| 24375 | 1023 |
| 24376 | 1023 |
| 24377 | 1023 |
| 24378 | 1023 |
| 24379 | 0 |
| 24380 | 0 |
| 24381 | 0 |
| 24382 | 0 |
| 24383 | 0 |
| 24384 | 0 |
| 24385 | 0 |
| 24386 | 0 |
| 24387 | 0 |
| 24388 | 0 |
| 24389 | 0 |
| 24390 | 0 |
| 24391 | 0 |
| 24392 | 0 |
| 24393 | 0 |
| 24394 | 1023 |
| 24395 | 1023 |
| 24396 | 1023 |
| 24397 | 1023 |
| 24398 | 1023 |
| 24399 | 1023 |
| 24400 | 1023 |
| 24401 | 1023 |
| 24402 | 1023 |
| 24403 | 1023 |
| 24404 | 1023 |
| 24405 | 1023 |
| 24406 | 1023 |
| 24407 | 1023 |
| 24408 | 1023 |
| 24409 | 1023 |
| 24410 | 1023 |
| 24411 | 1023 |
| 24412 | 1023 |
| 24413 | 1023 |
| 24414 | 1023 |
| 24415 | 1023 |
| 24416 | 1023 |
| 24417 | 1023 |
| 24418 | 1023 |
| 24419 | 1023 |
| 24420 | 1023 |
| 24421 | 1023 |
| 24422 | 1023 |
| 24423 | 1023 |
| 24424 | 1023 |
| 24425 | 1023 |
| 24426 | 1023 |
| 24427 | 1023 |
| 24428 | 1023 |
| 24429 | 1023 |
| 24430 | 1023 |
| 24431 | 1023 |
| 24432 | 0 |
| 24433 | 0 |
| 24434 | 0 |
| 24435 | 0 |
| 24436 | 0 |
| 24437 | 0 |
| 24438 | 0 |
| 24439 | 0 |
| 24440 | 0 |
| 24441 | 0 |
| 24442 | 0 |
| 24443 | 0 |
| 24444 | 0 |
| 24445 | 1023 |
| 24446 | 1023 |
| 24447 | 1023 |
| 24448 | 1023 |
| 24449 | 1023 |
| 24450 | 1023 |
| 24451 | 1023 |
| 24452 | 1023 |
| 24453 | 1023 |
| 24454 | 1023 |
| 24455 | 1023 |
| 24456 | 1023 |
| 24457 | 1023 |
| 24458 | 1023 |
| 24459 | 1023 |
| 24460 | 1023 |
| 24461 | 1023 |
| 24462 | 1023 |
| 24463 | 1023 |
| 24464 | 1023 |
| 24465 | 1023 |
| 24466 | 1023 |
| 24467 | 1023 |
| 24468 | 1023 |
| 24469 | 1023 |
| 24470 | 1023 |
| 24471 | 1023 |
| 24472 | 1023 |
| 24473 | 1023 |
| 24474 | 1023 |
| 24475 | 1023 |
| 24476 | 1023 |
| 24477 | 1023 |
| 24478 | 1023 |
| 24479 | 1023 |
| 24480 | 1023 |
| 24481 | 1023 |
| 24482 | 1023 |
| 24483 | 0 |
| 24484 | 0 |
| 24485 | 0 |
| 24486 | 0 |
| 24487 | 0 |
| 24488 | 0 |
| 24489 | 0 |
| 24490 | 0 |
| 24491 | 0 |
| 24492 | 0 |
| 24493 | 0 |
| 24494 | 0 |
| 24495 | 0 |
| 24496 | 1023 |
| 24497 | 1023 |
| 24498 | 1023 |
| 24499 | 1023 |
| 24500 | 1023 |
| 24501 | 1023 |
| 24502 | 1023 |
| 24503 | 1023 |
| 24504 | 1023 |
| 24505 | 1023 |
| 24506 | 1023 |
| 24507 | 1023 |
| 24508 | 1023 |
| 24509 | 1023 |
| 24510 | 1023 |
| 24511 | 1023 |
| 24512 | 1023 |
| 24513 | 1023 |
| 24514 | 1023 |
| 24515 | 1023 |
| 24516 | 1023 |
| 24517 | 1023 |
| 24518 | 1023 |
| 24519 | 1023 |
| 24520 | 1023 |
| 24521 | 1023 |
| 24522 | 1023 |
| 24523 | 1023 |
| 24524 | 1023 |
| 24525 | 1023 |
| 24526 | 1023 |
| 24527 | 1023 |
| 24528 | 1023 |
| 24529 | 1023 |
| 24530 | 1023 |
| 24531 | 1023 |
| 24532 | 1023 |
| 24533 | 1023 |
| 24534 | 0 |
| 24535 | 0 |
| 24536 | 0 |
| 24537 | 0 |
| 24538 | 0 |
| 24539 | 0 |
| 24540 | 0 |
| 24541 | 0 |
| 24542 | 0 |
| 24543 | 0 |
| 24544 | 0 |
| 24545 | 0 |
| 24546 | 0 |
| 24547 | 1023 |
| 24548 | 1023 |
| 24549 | 1023 |
| 24550 | 1023 |
| 24551 | 1023 |
| 24552 | 1023 |
| 24553 | 1023 |
| 24554 | 1023 |
| 24555 | 1023 |
| 24556 | 1023 |
| 24557 | 1023 |
| 24558 | 1023 |
| 24559 | 1023 |
| 24560 | 1023 |
| 24561 | 1023 |
| 24562 | 1023 |
| 24563 | 1023 |
| 24564 | 1023 |
| 24565 | 1023 |
| 24566 | 1023 |
| 24567 | 1023 |
| 24568 | 1023 |
| 24569 | 1023 |
| 24570 | 1023 |
| 24571 | 1023 |
| 24572 | 1023 |
| 24573 | 1023 |
| 24574 | 1023 |
| 24575 | 1023 |
| 24576 | 1023 |
| 24577 | 1023 |
| 24578 | 1023 |
| 24579 | 1023 |
| 24580 | 1023 |
| 24581 | 1023 |
| 24582 | 1023 |
| 24583 | 1023 |
| 24584 | 1023 |
| 24585 | 0 |
| 24586 | 0 |
| 24587 | 0 |
| 24588 | 0 |
| 24589 | 0 |
| 24590 | 0 |
| 24591 | 0 |
| 24592 | 0 |
| 24593 | 0 |
| 24594 | 0 |
| 24595 | 0 |
| 24596 | 0 |
| 24597 | 0 |
| 24598 | 1023 |
| 24599 | 1023 |
| 24600 | 1023 |
| 24601 | 1023 |
| 24602 | 1023 |
| 24603 | 1023 |
| 24604 | 1023 |
| 24605 | 1023 |
| 24606 | 1023 |
| 24607 | 1023 |
| 24608 | 1023 |
| 24609 | 1023 |
| 24610 | 1023 |
| 24611 | 1023 |
| 24612 | 1023 |
| 24613 | 1023 |
| 24614 | 1023 |
| 24615 | 1023 |
| 24616 | 1023 |
| 24617 | 1023 |
| 24618 | 1023 |
| 24619 | 1023 |
| 24620 | 1023 |
| 24621 | 1023 |
| 24622 | 1023 |
| 24623 | 1023 |
| 24624 | 1023 |
| 24625 | 1023 |
| 24626 | 1023 |
| 24627 | 1023 |
| 24628 | 1023 |
| 24629 | 1023 |
| 24630 | 1023 |
| 24631 | 1023 |
| 24632 | 1023 |
| 24633 | 1023 |
| 24634 | 1023 |
| 24635 | 1023 |
| 24636 | 0 |
| 24637 | 0 |
| 24638 | 0 |
| 24639 | 0 |
| 24640 | 0 |
| 24641 | 0 |
| 24642 | 0 |
| 24643 | 0 |
| 24644 | 0 |
| 24645 | 0 |
| 24646 | 0 |
| 24647 | 0 |
| 24648 | 0 |
| 24649 | 1023 |
| 24650 | 1023 |
| 24651 | 1023 |
| 24652 | 1023 |
| 24653 | 1023 |
| 24654 | 1023 |
| 24655 | 1023 |
| 24656 | 1023 |
| 24657 | 1023 |
| 24658 | 1023 |
| 24659 | 1023 |
| 24660 | 1023 |
| 24661 | 1023 |
| 24662 | 1023 |
| 24663 | 1023 |
| 24664 | 1023 |
| 24665 | 1023 |
| 24666 | 1023 |
| 24667 | 1023 |
| 24668 | 1023 |
| 24669 | 1023 |
| 24670 | 1023 |
| 24671 | 1023 |
| 24672 | 1023 |
| 24673 | 1023 |
| 24674 | 1023 |
| 24675 | 1023 |
| 24676 | 1023 |
| 24677 | 1023 |
| 24678 | 1023 |
| 24679 | 1023 |
| 24680 | 1023 |
| 24681 | 1023 |
| 24682 | 1023 |
| 24683 | 1023 |
| 24684 | 1023 |
| 24685 | 1023 |
| 24686 | 1023 |
| 24687 | 0 |
| 24688 | 0 |
| 24689 | 0 |
| 24690 | 0 |
| 24691 | 1 |
| 24692 | 0 |
| 24693 | 0 |
| 24694 | 0 |
| 24695 | 0 |
| 24696 | 0 |
| 24697 | 0 |
| 24698 | 0 |
| 24699 | 0 |
| 24700 | 1023 |
| 24701 | 1023 |
| 24702 | 1023 |
| 24703 | 1023 |
| 24704 | 1023 |
| 24705 | 1023 |
| 24706 | 1023 |
| 24707 | 1023 |
| 24708 | 1023 |
| 24709 | 1023 |
| 24710 | 1023 |
| 24711 | 1023 |
| 24712 | 1023 |
| 24713 | 1023 |
| 24714 | 1023 |
| 24715 | 1023 |
| 24716 | 1023 |
| 24717 | 1023 |
| 24718 | 1023 |
| 24719 | 1023 |
| 24720 | 1023 |
| 24721 | 1023 |
| 24722 | 1023 |
| 24723 | 1023 |
| 24724 | 1023 |
| 24725 | 1023 |
| 24726 | 1023 |
| 24727 | 1023 |
| 24728 | 1023 |
| 24729 | 1023 |
| 24730 | 1023 |
| 24731 | 1023 |
| 24732 | 1023 |
| 24733 | 1023 |
| 24734 | 1023 |
| 24735 | 1023 |
| 24736 | 1023 |
| 24737 | 1023 |
| 24738 | 0 |
| 24739 | 0 |
| 24740 | 0 |
| 24741 | 0 |
| 24742 | 0 |
| 24743 | 0 |
| 24744 | 0 |
| 24745 | 0 |
| 24746 | 0 |
| 24747 | 0 |
| 24748 | 0 |
| 24749 | 0 |
| 24750 | 0 |
| 24751 | 1023 |
| 24752 | 1023 |
| 24753 | 1023 |
| 24754 | 1023 |
| 24755 | 1023 |
| 24756 | 1023 |
| 24757 | 1023 |
| 24758 | 1023 |
| 24759 | 1023 |
| 24760 | 1023 |
| 24761 | 1023 |
| 24762 | 1023 |
| 24763 | 1023 |
| 24764 | 1023 |
| 24765 | 1023 |
| 24766 | 1023 |
| 24767 | 1023 |
| 24768 | 1023 |
| 24769 | 1023 |
| 24770 | 1023 |
| 24771 | 1023 |
| 24772 | 1023 |
| 24773 | 1023 |
| 24774 | 1023 |
| 24775 | 1023 |
| 24776 | 1023 |
| 24777 | 1023 |
| 24778 | 1023 |
| 24779 | 1023 |
| 24780 | 1023 |
| 24781 | 1023 |
| 24782 | 1023 |
| 24783 | 1023 |
| 24784 | 1023 |
| 24785 | 1023 |
| 24786 | 1023 |
| 24787 | 1023 |
| 24788 | 1023 |
| 24789 | 0 |
| 24790 | 0 |
| 24791 | 0 |
| 24792 | 0 |
| 24793 | 0 |
| 24794 | 0 |
| 24795 | 0 |
| 24796 | 0 |
| 24797 | 0 |
| 24798 | 0 |
| 24799 | 0 |
| 24800 | 0 |
| 24801 | 0 |
| 24802 | 0 |
| 24803 | 1023 |
| 24804 | 1023 |
| 24805 | 1023 |
| 24806 | 1023 |
| 24807 | 1023 |
| 24808 | 1023 |
| 24809 | 1023 |
| 24810 | 1023 |
| 24811 | 1023 |
| 24812 | 1023 |
| 24813 | 1023 |
| 24814 | 1023 |
| 24815 | 1023 |
| 24816 | 1023 |
| 24817 | 1023 |
| 24818 | 1023 |
| 24819 | 1023 |
| 24820 | 1023 |
| 24821 | 1023 |
| 24822 | 1023 |
| 24823 | 1023 |
| 24824 | 1023 |
| 24825 | 1023 |
| 24826 | 1023 |
| 24827 | 1023 |
| 24828 | 1023 |
| 24829 | 1023 |
| 24830 | 1023 |
| 24831 | 1023 |
| 24832 | 1023 |
| 24833 | 1023 |
| 24834 | 1023 |
| 24835 | 1023 |
| 24836 | 1023 |
| 24837 | 1023 |
| 24838 | 1023 |
| 24839 | 1023 |
| 24840 | 0 |
| 24841 | 0 |
| 24842 | 0 |
| 24843 | 0 |
| 24844 | 0 |
| 24845 | 0 |
| 24846 | 0 |
| 24847 | 0 |
| 24848 | 0 |
| 24849 | 0 |
| 24850 | 0 |
| 24851 | 0 |
| 24852 | 0 |
| 24853 | 0 |
| 24854 | 0 |
| 24855 | 1023 |
| 24856 | 1023 |
| 24857 | 1023 |
| 24858 | 1023 |
| 24859 | 1023 |
| 24860 | 1023 |
| 24861 | 1023 |
| 24862 | 1023 |
| 24863 | 1023 |
| 24864 | 1023 |
| 24865 | 1023 |
| 24866 | 1023 |
| 24867 | 1023 |
| 24868 | 1023 |
| 24869 | 1023 |
| 24870 | 1023 |
| 24871 | 1023 |
| 24872 | 1023 |
| 24873 | 1023 |
| 24874 | 1023 |
| 24875 | 1023 |
| 24876 | 1023 |
| 24877 | 1023 |
| 24878 | 1023 |
| 24879 | 1023 |
| 24880 | 1023 |
| 24881 | 1023 |
| 24882 | 1023 |
| 24883 | 1023 |
| 24884 | 1023 |
| 24885 | 1023 |
| 24886 | 1023 |
| 24887 | 1023 |
| 24888 | 1023 |
| 24889 | 1023 |
| 24890 | 1023 |
| 24891 | 1023 |
| 24892 | 0 |
| 24893 | 0 |
| 24894 | 0 |
| 24895 | 0 |
| 24896 | 1 |
| 24897 | 0 |
| 24898 | 0 |
| 24899 | 0 |
| 24900 | 0 |
| 24901 | 0 |
| 24902 | 0 |
| 24903 | 0 |
| 24904 | 0 |
| 24905 | 0 |
| 24906 | 0 |
| 24907 | 1023 |
| 24908 | 1023 |
| 24909 | 1023 |
| 24910 | 1023 |
| 24911 | 1023 |
| 24912 | 1023 |
| 24913 | 1023 |
| 24914 | 1023 |
| 24915 | 1023 |
| 24916 | 1023 |
| 24917 | 1023 |
| 24918 | 1023 |
| 24919 | 1023 |
| 24920 | 1023 |
| 24921 | 1023 |
| 24922 | 1023 |
| 24923 | 1023 |
| 24924 | 1023 |
| 24925 | 1023 |
| 24926 | 1023 |
| 24927 | 1023 |
| 24928 | 1023 |
| 24929 | 1023 |
| 24930 | 1023 |
| 24931 | 1023 |
| 24932 | 1023 |
| 24933 | 1023 |
| 24934 | 1023 |
| 24935 | 1023 |
| 24936 | 1023 |
| 24937 | 1023 |
| 24938 | 1023 |
| 24939 | 1023 |
| 24940 | 1023 |
| 24941 | 1023 |
| 24942 | 1023 |
| 24943 | 1023 |
| 24944 | 0 |
| 24945 | 0 |
| 24946 | 0 |
| 24947 | 0 |
| 24948 | 0 |
| 24949 | 0 |
| 24950 | 0 |
| 24951 | 0 |
| 24952 | 0 |
| 24953 | 0 |
| 24954 | 0 |
| 24955 | 0 |
| 24956 | 0 |
| 24957 | 0 |
| 24958 | 0 |
| 24959 | 1023 |
| 24960 | 1023 |
| 24961 | 1023 |
| 24962 | 1023 |
| 24963 | 1023 |
| 24964 | 1023 |
| 24965 | 1023 |
| 24966 | 1023 |
| 24967 | 1023 |
| 24968 | 1023 |
| 24969 | 1023 |
| 24970 | 1023 |
| 24971 | 1023 |
| 24972 | 1023 |
| 24973 | 1023 |
| 24974 | 1023 |
| 24975 | 1023 |
| 24976 | 1023 |
| 24977 | 1023 |
| 24978 | 1023 |
| 24979 | 1023 |
| 24980 | 1023 |
| 24981 | 1023 |
| 24982 | 1023 |
| 24983 | 1023 |
| 24984 | 1023 |
| 24985 | 1023 |
| 24986 | 1023 |
| 24987 | 1023 |
| 24988 | 1023 |
| 24989 | 1023 |
| 24990 | 1023 |
| 24991 | 1023 |
| 24992 | 1023 |
| 24993 | 1023 |
| 24994 | 1023 |
| 24995 | 1023 |
| 24996 | 0 |
| 24997 | 0 |
| 24998 | 0 |
| 24999 | 0 |
| 25000 | 0 |
| 25001 | 0 |
| 25002 | 0 |
| 25003 | 0 |
| 25004 | 0 |
| 25005 | 0 |
| 25006 | 0 |
| 25007 | 0 |
| 25008 | 0 |
| 25009 | 0 |
| 25010 | 0 |
| 25011 | 1023 |
| 25012 | 1023 |
| 25013 | 1023 |
| 25014 | 1023 |
| 25015 | 1023 |
| 25016 | 1023 |
| 25017 | 1023 |
| 25018 | 1023 |
| 25019 | 1023 |
| 25020 | 1023 |
| 25021 | 1023 |
| 25022 | 1023 |
| 25023 | 1023 |
| 25024 | 1023 |
| 25025 | 1023 |
| 25026 | 1023 |
| 25027 | 1023 |
| 25028 | 1023 |
| 25029 | 1023 |
| 25030 | 1023 |
| 25031 | 1023 |
| 25032 | 1023 |
| 25033 | 1023 |
| 25034 | 1023 |
| 25035 | 1023 |
| 25036 | 1023 |
| 25037 | 1023 |
| 25038 | 1023 |
| 25039 | 1023 |
| 25040 | 1023 |
| 25041 | 1023 |
| 25042 | 1023 |
| 25043 | 1023 |
| 25044 | 1023 |
| 25045 | 1023 |
| 25046 | 1023 |
| 25047 | 1023 |
| 25048 | 1023 |
| 25049 | 0 |
| 25050 | 0 |
| 25051 | 0 |
| 25052 | 0 |
| 25053 | 0 |
| 25054 | 0 |
| 25055 | 0 |
| 25056 | 0 |
| 25057 | 0 |
| 25058 | 0 |
| 25059 | 0 |
| 25060 | 0 |
| 25061 | 0 |
| 25062 | 1023 |
| 25063 | 1023 |
| 25064 | 1023 |
| 25065 | 1023 |
| 25066 | 1023 |
| 25067 | 1023 |
| 25068 | 1023 |
| 25069 | 1023 |
| 25070 | 1023 |
| 25071 | 1023 |
| 25072 | 1023 |
| 25073 | 1023 |
| 25074 | 1023 |
| 25075 | 1023 |
| 25076 | 1023 |
| 25077 | 1023 |
| 25078 | 1023 |
| 25079 | 1023 |
| 25080 | 1023 |
| 25081 | 1023 |
| 25082 | 1023 |
| 25083 | 1023 |
| 25084 | 1023 |
| 25085 | 1023 |
| 25086 | 1023 |
| 25087 | 1023 |
| 25088 | 1023 |
| 25089 | 1023 |
| 25090 | 1023 |
| 25091 | 1023 |
| 25092 | 1023 |
| 25093 | 1023 |
| 25094 | 1023 |
| 25095 | 1023 |
| 25096 | 1023 |
| 25097 | 1023 |
| 25098 | 1023 |
| 25099 | 1023 |
| 25100 | 0 |
| 25101 | 0 |
| 25102 | 0 |
| 25103 | 0 |
| 25104 | 0 |
| 25105 | 1 |
| 25106 | 0 |
| 25107 | 0 |
| 25108 | 0 |
| 25109 | 0 |
| 25110 | 0 |
| 25111 | 0 |
| 25112 | 0 |
| 25113 | 1023 |
| 25114 | 1023 |
| 25115 | 1023 |
| 25116 | 1023 |
| 25117 | 1023 |
| 25118 | 1023 |
| 25119 | 1023 |
| 25120 | 1023 |
| 25121 | 1023 |
| 25122 | 1023 |
| 25123 | 1023 |
| 25124 | 1023 |
| 25125 | 1023 |
| 25126 | 1023 |
| 25127 | 1023 |
| 25128 | 1023 |
| 25129 | 1023 |
| 25130 | 1023 |
| 25131 | 1023 |
| 25132 | 1023 |
| 25133 | 1023 |
| 25134 | 1023 |
| 25135 | 1023 |
| 25136 | 1023 |
| 25137 | 1023 |
| 25138 | 1023 |
| 25139 | 1023 |
| 25140 | 1023 |
| 25141 | 1023 |
| 25142 | 1023 |
| 25143 | 1023 |
| 25144 | 1023 |
| 25145 | 1023 |
| 25146 | 1023 |
| 25147 | 1023 |
| 25148 | 1023 |
| 25149 | 1023 |
| 25150 | 1023 |
| 25151 | 0 |
| 25152 | 0 |
| 25153 | 0 |
| 25154 | 0 |
| 25155 | 0 |
| 25156 | 0 |
| 25157 | 0 |
| 25158 | 0 |
| 25159 | 0 |
| 25160 | 0 |
| 25161 | 0 |
| 25162 | 0 |
| 25163 | 0 |
| 25164 | 1023 |
| 25165 | 1023 |
| 25166 | 1023 |
| 25167 | 1023 |
| 25168 | 1023 |
| 25169 | 1023 |
| 25170 | 1023 |
| 25171 | 1023 |
| 25172 | 1023 |
| 25173 | 1023 |
| 25174 | 1023 |
| 25175 | 1023 |
| 25176 | 1023 |
| 25177 | 1023 |
| 25178 | 1023 |
| 25179 | 1023 |
| 25180 | 1023 |
| 25181 | 1023 |
| 25182 | 1023 |
| 25183 | 1023 |
| 25184 | 1023 |
| 25185 | 1023 |
| 25186 | 1023 |
| 25187 | 1023 |
| 25188 | 1023 |
| 25189 | 1023 |
| 25190 | 1023 |
| 25191 | 1023 |
| 25192 | 1023 |
| 25193 | 1023 |
| 25194 | 1023 |
| 25195 | 1023 |
| 25196 | 1023 |
| 25197 | 1023 |
| 25198 | 1023 |
| 25199 | 1023 |
| 25200 | 1023 |
| 25201 | 1023 |
| 25202 | 0 |
| 25203 | 0 |
| 25204 | 0 |
| 25205 | 0 |
| 25206 | 0 |
| 25207 | 0 |
| 25208 | 0 |
| 25209 | 0 |
| 25210 | 0 |
| 25211 | 0 |
| 25212 | 0 |
| 25213 | 0 |
| 25214 | 0 |
| 25215 | 1023 |
| 25216 | 1023 |
| 25217 | 1023 |
| 25218 | 1023 |
| 25219 | 1023 |
| 25220 | 1023 |
| 25221 | 1023 |
| 25222 | 1023 |
| 25223 | 1023 |
| 25224 | 1023 |
| 25225 | 1023 |
| 25226 | 1023 |
| 25227 | 1023 |
| 25228 | 1023 |
| 25229 | 1023 |
| 25230 | 1023 |
| 25231 | 1023 |
| 25232 | 1023 |
| 25233 | 1023 |
| 25234 | 1023 |
| 25235 | 1023 |
| 25236 | 1023 |
| 25237 | 1023 |
| 25238 | 1023 |
| 25239 | 1023 |
| 25240 | 1023 |
| 25241 | 1023 |
| 25242 | 1023 |
| 25243 | 1023 |
| 25244 | 1023 |
| 25245 | 1023 |
| 25246 | 1023 |
| 25247 | 1023 |
| 25248 | 1023 |
| 25249 | 1023 |
| 25250 | 1023 |
| 25251 | 1023 |
| 25252 | 1023 |
| 25253 | 0 |
| 25254 | 0 |
| 25255 | 0 |
| 25256 | 0 |
| 25257 | 0 |
| 25258 | 0 |
| 25259 | 0 |
| 25260 | 0 |
| 25261 | 0 |
| 25262 | 0 |
| 25263 | 0 |
| 25264 | 0 |
| 25265 | 0 |
| 25266 | 1023 |
| 25267 | 1023 |
| 25268 | 1023 |
| 25269 | 1023 |
| 25270 | 1023 |
| 25271 | 1023 |
| 25272 | 1023 |
| 25273 | 1023 |
| 25274 | 1023 |
| 25275 | 1023 |
| 25276 | 1023 |
| 25277 | 1023 |
| 25278 | 1023 |
| 25279 | 1023 |
| 25280 | 1023 |
| 25281 | 1023 |
| 25282 | 1023 |
| 25283 | 1023 |
| 25284 | 1023 |
| 25285 | 1023 |
| 25286 | 1023 |
| 25287 | 1023 |
| 25288 | 1023 |
| 25289 | 1023 |
| 25290 | 1023 |
| 25291 | 1023 |
| 25292 | 1023 |
| 25293 | 1023 |
| 25294 | 1023 |
| 25295 | 1023 |
| 25296 | 1023 |
| 25297 | 1023 |
| 25298 | 1023 |
| 25299 | 1023 |
| 25300 | 1023 |
| 25301 | 1023 |
| 25302 | 1023 |
| 25303 | 1023 |
| 25304 | 0 |
| 25305 | 0 |
| 25306 | 0 |
| 25307 | 0 |
| 25308 | 0 |
| 25309 | 0 |
| 25310 | 0 |
| 25311 | 0 |
| 25312 | 0 |
| 25313 | 0 |
| 25314 | 0 |
| 25315 | 0 |
| 25316 | 0 |
| 25317 | 1023 |
| 25318 | 1023 |
| 25319 | 1023 |
| 25320 | 1023 |
| 25321 | 1023 |
| 25322 | 1023 |
| 25323 | 1023 |
| 25324 | 1023 |
| 25325 | 1023 |
| 25326 | 1023 |
| 25327 | 1023 |
| 25328 | 1023 |
| 25329 | 1023 |
| 25330 | 1023 |
| 25331 | 1023 |
| 25332 | 1023 |
| 25333 | 1023 |
| 25334 | 1023 |
| 25335 | 1023 |
| 25336 | 1023 |
| 25337 | 1023 |
| 25338 | 1023 |
| 25339 | 1023 |
| 25340 | 1023 |
| 25341 | 1023 |
| 25342 | 1023 |
| 25343 | 1023 |
| 25344 | 1023 |
| 25345 | 1023 |
| 25346 | 1023 |
| 25347 | 1023 |
| 25348 | 1023 |
| 25349 | 1023 |
| 25350 | 1023 |
| 25351 | 1023 |
| 25352 | 1023 |
| 25353 | 1023 |
| 25354 | 1023 |
| 25355 | 0 |
| 25356 | 0 |
| 25357 | 0 |
| 25358 | 0 |
| 25359 | 0 |
| 25360 | 0 |
| 25361 | 0 |
| 25362 | 0 |
| 25363 | 0 |
| 25364 | 0 |
| 25365 | 0 |
| 25366 | 0 |
| 25367 | 0 |
| 25368 | 0 |
| 25369 | 1023 |
| 25370 | 1023 |
| 25371 | 1023 |
| 25372 | 1023 |
| 25373 | 1023 |
| 25374 | 1023 |
| 25375 | 1023 |
| 25376 | 1023 |
| 25377 | 1023 |
| 25378 | 1023 |
| 25379 | 1023 |
| 25380 | 1023 |
| 25381 | 1023 |
| 25382 | 1023 |
| 25383 | 1023 |
| 25384 | 1023 |
| 25385 | 1023 |
| 25386 | 1023 |
| 25387 | 1023 |
| 25388 | 1023 |
| 25389 | 1023 |
| 25390 | 1023 |
| 25391 | 1023 |
| 25392 | 1023 |
| 25393 | 1023 |
| 25394 | 1023 |
| 25395 | 1023 |
| 25396 | 1023 |
| 25397 | 1023 |
| 25398 | 1023 |
| 25399 | 1023 |
| 25400 | 1023 |
| 25401 | 1023 |
| 25402 | 1023 |
| 25403 | 1023 |
| 25404 | 1023 |
| 25405 | 1023 |
| 25406 | 0 |
| 25407 | 0 |
| 25408 | 0 |
| 25409 | 0 |
| 25410 | 0 |
| 25411 | 0 |
| 25412 | 0 |
| 25413 | 0 |
| 25414 | 0 |
| 25415 | 0 |
| 25416 | 0 |
| 25417 | 0 |
| 25418 | 0 |
| 25419 | 0 |
| 25420 | 0 |
| 25421 | 1023 |
| 25422 | 1023 |
| 25423 | 1023 |
| 25424 | 1023 |
| 25425 | 1023 |
| 25426 | 1023 |
| 25427 | 1023 |
| 25428 | 1023 |
| 25429 | 1023 |
| 25430 | 1023 |
| 25431 | 1023 |
| 25432 | 1023 |
| 25433 | 1023 |
| 25434 | 1023 |
| 25435 | 1023 |
| 25436 | 1023 |
| 25437 | 1023 |
| 25438 | 1023 |
| 25439 | 1023 |
| 25440 | 1023 |
| 25441 | 1023 |
| 25442 | 1023 |
| 25443 | 1023 |
| 25444 | 1023 |
| 25445 | 1023 |
| 25446 | 1023 |
| 25447 | 1023 |
| 25448 | 1023 |
| 25449 | 1023 |
| 25450 | 1023 |
| 25451 | 1023 |
| 25452 | 1023 |
| 25453 | 1023 |
| 25454 | 1023 |
| 25455 | 1023 |
| 25456 | 1023 |
| 25457 | 1023 |
| 25458 | 0 |
| 25459 | 1 |
| 25460 | 1 |
| 25461 | 0 |
| 25462 | 0 |
| 25463 | 0 |
| 25464 | 0 |
| 25465 | 0 |
| 25466 | 0 |
| 25467 | 0 |
| 25468 | 0 |
| 25469 | 0 |
| 25470 | 0 |
| 25471 | 0 |
| 25472 | 1023 |
| 25473 | 1023 |
| 25474 | 1023 |
| 25475 | 1023 |
| 25476 | 1023 |
| 25477 | 1023 |
| 25478 | 1023 |
| 25479 | 1023 |
| 25480 | 1023 |
| 25481 | 1023 |
| 25482 | 1023 |
| 25483 | 1023 |
| 25484 | 1023 |
| 25485 | 1023 |
| 25486 | 1023 |
| 25487 | 1023 |
| 25488 | 1023 |
| 25489 | 1023 |
| 25490 | 1023 |
| 25491 | 1023 |
| 25492 | 1023 |
| 25493 | 1023 |
| 25494 | 1023 |
| 25495 | 1023 |
| 25496 | 1023 |
| 25497 | 1023 |
| 25498 | 1023 |
| 25499 | 1023 |
| 25500 | 1023 |
| 25501 | 1023 |
| 25502 | 1023 |
| 25503 | 1023 |
| 25504 | 1023 |
| 25505 | 1023 |
| 25506 | 1023 |
| 25507 | 1023 |
| 25508 | 1023 |
| 25509 | 1023 |
| 25510 | 0 |
| 25511 | 0 |
| 25512 | 0 |
| 25513 | 0 |
| 25514 | 0 |
| 25515 | 0 |
| 25516 | 0 |
| 25517 | 0 |
| 25518 | 0 |
| 25519 | 0 |
| 25520 | 0 |
| 25521 | 0 |
| 25522 | 0 |
| 25523 | 0 |
| 25524 | 1023 |
| 25525 | 1023 |
| 25526 | 1023 |
| 25527 | 1023 |
| 25528 | 1023 |
| 25529 | 1023 |
| 25530 | 1023 |
| 25531 | 1023 |
| 25532 | 1023 |
| 25533 | 1023 |
| 25534 | 1023 |
| 25535 | 1023 |
| 25536 | 1023 |
| 25537 | 1023 |
| 25538 | 1023 |
| 25539 | 1023 |
| 25540 | 1023 |
| 25541 | 1023 |
| 25542 | 1023 |
| 25543 | 1023 |
| 25544 | 1023 |
| 25545 | 1023 |
| 25546 | 1023 |
| 25547 | 1023 |
| 25548 | 1023 |
| 25549 | 1023 |
| 25550 | 1023 |
| 25551 | 1023 |
| 25552 | 1023 |
| 25553 | 1023 |
| 25554 | 1023 |
| 25555 | 1023 |
| 25556 | 1023 |
| 25557 | 1023 |
| 25558 | 1023 |
| 25559 | 1023 |
| 25560 | 1023 |
| 25561 | 0 |
| 25562 | 0 |
| 25563 | 0 |
| 25564 | 0 |
| 25565 | 0 |
| 25566 | 0 |
| 25567 | 0 |
| 25568 | 0 |
| 25569 | 0 |
| 25570 | 0 |
| 25571 | 0 |
| 25572 | 0 |
| 25573 | 0 |
| 25574 | 0 |
| 25575 | 0 |
| 25576 | 1023 |
| 25577 | 1023 |
| 25578 | 1023 |
| 25579 | 1023 |
| 25580 | 1023 |
| 25581 | 1023 |
| 25582 | 1023 |
| 25583 | 1023 |
| 25584 | 1023 |
| 25585 | 1023 |
| 25586 | 1023 |
| 25587 | 1023 |
| 25588 | 1023 |
| 25589 | 1023 |
| 25590 | 1023 |
| 25591 | 1023 |
| 25592 | 1023 |
| 25593 | 1023 |
| 25594 | 1023 |
| 25595 | 1023 |
| 25596 | 1023 |
| 25597 | 1023 |
| 25598 | 1023 |
| 25599 | 1023 |
| 25600 | 1023 |
| 25601 | 1023 |
| 25602 | 1023 |
| 25603 | 1023 |
| 25604 | 1023 |
| 25605 | 1023 |
| 25606 | 1023 |
| 25607 | 1023 |
| 25608 | 1023 |
| 25609 | 1023 |
| 25610 | 1023 |
| 25611 | 1023 |
| 25612 | 1023 |
| 25613 | 1023 |
| 25614 | 0 |
| 25615 | 0 |
| 25616 | 0 |
| 25617 | 0 |
| 25618 | 0 |
| 25619 | 0 |
| 25620 | 0 |
| 25621 | 0 |
| 25622 | 0 |
| 25623 | 0 |
| 25624 | 0 |
| 25625 | 0 |
| 25626 | 0 |
| 25627 | 1023 |
| 25628 | 1023 |
| 25629 | 1023 |
| 25630 | 1023 |
| 25631 | 1023 |
| 25632 | 1023 |
| 25633 | 1023 |
| 25634 | 1023 |
| 25635 | 1023 |
| 25636 | 1023 |
| 25637 | 1023 |
| 25638 | 1023 |
| 25639 | 1023 |
| 25640 | 1023 |
| 25641 | 1023 |
| 25642 | 1023 |
| 25643 | 1023 |
| 25644 | 1023 |
| 25645 | 1023 |
| 25646 | 1023 |
| 25647 | 1023 |
| 25648 | 1023 |
| 25649 | 1023 |
| 25650 | 1023 |
| 25651 | 1023 |
| 25652 | 1023 |
| 25653 | 1023 |
| 25654 | 1023 |
| 25655 | 1023 |
| 25656 | 1023 |
| 25657 | 1023 |
| 25658 | 1023 |
| 25659 | 1023 |
| 25660 | 1023 |
| 25661 | 1023 |
| 25662 | 1023 |
| 25663 | 1023 |
| 25664 | 1023 |
| 25665 | 0 |
| 25666 | 0 |
| 25667 | 0 |
| 25668 | 0 |
| 25669 | 0 |
| 25670 | 0 |
| 25671 | 0 |
| 25672 | 0 |
| 25673 | 0 |
| 25674 | 0 |
| 25675 | 0 |
| 25676 | 0 |
| 25677 | 0 |
| 25678 | 1023 |
| 25679 | 1023 |
| 25680 | 1023 |
| 25681 | 1023 |
| 25682 | 1023 |
| 25683 | 1023 |
| 25684 | 1023 |
| 25685 | 1023 |
| 25686 | 1023 |
| 25687 | 1023 |
| 25688 | 1023 |
| 25689 | 1023 |
| 25690 | 1023 |
| 25691 | 1023 |
| 25692 | 1023 |
| 25693 | 1023 |
| 25694 | 1023 |
| 25695 | 1023 |
| 25696 | 1023 |
| 25697 | 1023 |
| 25698 | 1023 |
| 25699 | 1023 |
| 25700 | 1023 |
| 25701 | 1023 |
| 25702 | 1023 |
| 25703 | 1023 |
| 25704 | 1023 |
| 25705 | 1023 |
| 25706 | 1023 |
| 25707 | 1023 |
| 25708 | 1023 |
| 25709 | 1023 |
| 25710 | 1023 |
| 25711 | 1023 |
| 25712 | 1023 |
| 25713 | 1023 |
| 25714 | 1023 |
| 25715 | 1023 |
| 25716 | 0 |
| 25717 | 0 |
| 25718 | 0 |
| 25719 | 0 |
| 25720 | 0 |
| 25721 | 0 |
| 25722 | 0 |
| 25723 | 0 |
| 25724 | 0 |
| 25725 | 0 |
| 25726 | 0 |
| 25727 | 0 |
| 25728 | 0 |
| 25729 | 1023 |
| 25730 | 1023 |
| 25731 | 1023 |
| 25732 | 1023 |
| 25733 | 1023 |
| 25734 | 1023 |
| 25735 | 1023 |
| 25736 | 1023 |
| 25737 | 1023 |
| 25738 | 1023 |
| 25739 | 1023 |
| 25740 | 1023 |
| 25741 | 1023 |
| 25742 | 1023 |
| 25743 | 1023 |
| 25744 | 1023 |
| 25745 | 1023 |
| 25746 | 1023 |
| 25747 | 1023 |
| 25748 | 1023 |
| 25749 | 1023 |
| 25750 | 1023 |
| 25751 | 1023 |
| 25752 | 1023 |
| 25753 | 1023 |
| 25754 | 1023 |
| 25755 | 1023 |
| 25756 | 1023 |
| 25757 | 1023 |
| 25758 | 1023 |
| 25759 | 1023 |
| 25760 | 1023 |
| 25761 | 1023 |
| 25762 | 1023 |
| 25763 | 1023 |
| 25764 | 1023 |
| 25765 | 1023 |
| 25766 | 1023 |
| 25767 | 0 |
| 25768 | 0 |
| 25769 | 0 |
| 25770 | 0 |
| 25771 | 0 |
| 25772 | 0 |
| 25773 | 0 |
| 25774 | 0 |
| 25775 | 0 |
| 25776 | 0 |
| 25777 | 0 |
| 25778 | 0 |
| 25779 | 0 |
| 25780 | 1023 |
| 25781 | 1023 |
| 25782 | 1023 |
| 25783 | 1023 |
| 25784 | 1023 |
| 25785 | 1023 |
| 25786 | 1023 |
| 25787 | 1023 |
| 25788 | 1023 |
| 25789 | 1023 |
| 25790 | 1023 |
| 25791 | 1023 |
| 25792 | 1023 |
| 25793 | 1023 |
| 25794 | 1023 |
| 25795 | 1023 |
| 25796 | 1023 |
| 25797 | 1023 |
| 25798 | 1023 |
| 25799 | 1023 |
| 25800 | 1023 |
| 25801 | 1023 |
| 25802 | 1023 |
| 25803 | 1023 |
| 25804 | 1023 |
| 25805 | 1023 |
| 25806 | 1023 |
| 25807 | 1023 |
| 25808 | 1023 |
| 25809 | 1023 |
| 25810 | 1023 |
| 25811 | 1023 |
| 25812 | 1023 |
| 25813 | 1023 |
| 25814 | 1023 |
| 25815 | 1023 |
| 25816 | 1023 |
| 25817 | 1023 |
| 25818 | 0 |
| 25819 | 0 |
| 25820 | 0 |
| 25821 | 0 |
| 25822 | 0 |
| 25823 | 0 |
| 25824 | 0 |
| 25825 | 0 |
| 25826 | 0 |
| 25827 | 0 |
| 25828 | 0 |
| 25829 | 0 |
| 25830 | 0 |
| 25831 | 1023 |
| 25832 | 1023 |
| 25833 | 1023 |
| 25834 | 1023 |
| 25835 | 1023 |
| 25836 | 1023 |
| 25837 | 1023 |
| 25838 | 1023 |
| 25839 | 1023 |
| 25840 | 1023 |
| 25841 | 1023 |
| 25842 | 1023 |
| 25843 | 1023 |
| 25844 | 1023 |
| 25845 | 1023 |
| 25846 | 1023 |
| 25847 | 1023 |
| 25848 | 1023 |
| 25849 | 1023 |
| 25850 | 1023 |
| 25851 | 1023 |
| 25852 | 1023 |
| 25853 | 1023 |
| 25854 | 1023 |
| 25855 | 1023 |
| 25856 | 1023 |
| 25857 | 1023 |
| 25858 | 1023 |
| 25859 | 1023 |
| 25860 | 1023 |
| 25861 | 1023 |
| 25862 | 1023 |
| 25863 | 1023 |
| 25864 | 1023 |
| 25865 | 1023 |
| 25866 | 1023 |
| 25867 | 1023 |
| 25868 | 1023 |
| 25869 | 0 |
| 25870 | 0 |
| 25871 | 0 |
| 25872 | 0 |
| 25873 | 0 |
| 25874 | 0 |
| 25875 | 0 |
| 25876 | 0 |
| 25877 | 0 |
| 25878 | 0 |
| 25879 | 0 |
| 25880 | 0 |
| 25881 | 0 |
| 25882 | 1023 |
| 25883 | 1023 |
| 25884 | 1023 |
| 25885 | 1023 |
| 25886 | 1023 |
| 25887 | 1023 |
| 25888 | 1023 |
| 25889 | 1023 |
| 25890 | 1023 |
| 25891 | 1023 |
| 25892 | 1023 |
| 25893 | 1023 |
| 25894 | 1023 |
| 25895 | 1023 |
| 25896 | 1023 |
| 25897 | 1023 |
| 25898 | 1023 |
| 25899 | 1023 |
| 25900 | 1023 |
| 25901 | 1023 |
| 25902 | 1023 |
| 25903 | 1023 |
| 25904 | 1023 |
| 25905 | 1023 |
| 25906 | 1023 |
| 25907 | 1023 |
| 25908 | 1023 |
| 25909 | 1023 |
| 25910 | 1023 |
| 25911 | 1023 |
| 25912 | 1023 |
| 25913 | 1023 |
| 25914 | 1023 |
| 25915 | 1023 |
| 25916 | 1023 |
| 25917 | 1023 |
| 25918 | 1023 |
| 25919 | 1023 |
| 25920 | 0 |
| 25921 | 0 |
| 25922 | 0 |
| 25923 | 0 |
| 25924 | 0 |
| 25925 | 0 |
| 25926 | 0 |
| 25927 | 0 |
| 25928 | 0 |
| 25929 | 0 |
| 25930 | 0 |
| 25931 | 0 |
| 25932 | 0 |
| 25933 | 0 |
| 25934 | 1023 |
| 25935 | 1023 |
| 25936 | 1023 |
| 25937 | 1023 |
| 25938 | 1023 |
| 25939 | 1023 |
| 25940 | 1023 |
| 25941 | 1023 |
| 25942 | 1023 |
| 25943 | 1023 |
| 25944 | 1023 |
| 25945 | 1023 |
| 25946 | 1023 |
| 25947 | 1023 |
| 25948 | 1023 |
| 25949 | 1023 |
| 25950 | 1023 |
| 25951 | 1023 |
| 25952 | 1023 |
| 25953 | 1023 |
| 25954 | 1023 |
| 25955 | 1023 |
| 25956 | 1023 |
| 25957 | 1023 |
| 25958 | 1023 |
| 25959 | 1023 |
| 25960 | 1023 |
| 25961 | 1023 |
| 25962 | 1023 |
| 25963 | 1023 |
| 25964 | 1023 |
| 25965 | 1023 |
| 25966 | 1023 |
| 25967 | 1023 |
| 25968 | 1023 |
| 25969 | 1023 |
| 25970 | 1023 |
| 25971 | 0 |
| 25972 | 0 |
| 25973 | 0 |
| 25974 | 0 |
| 25975 | 0 |
| 25976 | 0 |
| 25977 | 0 |
| 25978 | 0 |
| 25979 | 0 |
| 25980 | 0 |
| 25981 | 0 |
| 25982 | 0 |
| 25983 | 0 |
| 25984 | 0 |
| 25985 | 1023 |
| 25986 | 1023 |
| 25987 | 1023 |
| 25988 | 1023 |
| 25989 | 1023 |
| 25990 | 1023 |
| 25991 | 1023 |
| 25992 | 1023 |
| 25993 | 1023 |
| 25994 | 1023 |
| 25995 | 1023 |
| 25996 | 1023 |
| 25997 | 1023 |
| 25998 | 1023 |
| 25999 | 1023 |
| 26000 | 1023 |
| 26001 | 1023 |
| 26002 | 1023 |
| 26003 | 1023 |
| 26004 | 1023 |
| 26005 | 1023 |
| 26006 | 1023 |
| 26007 | 1023 |
| 26008 | 1023 |
| 26009 | 1023 |
| 26010 | 1023 |
| 26011 | 1023 |
| 26012 | 1023 |
| 26013 | 1023 |
| 26014 | 1023 |
| 26015 | 1023 |
| 26016 | 1023 |
| 26017 | 1023 |
| 26018 | 1023 |
| 26019 | 1023 |
| 26020 | 1023 |
| 26021 | 1023 |
| 26022 | 1023 |
| 26023 | 0 |
| 26024 | 0 |
| 26025 | 0 |
| 26026 | 0 |
| 26027 | 0 |
| 26028 | 0 |
| 26029 | 0 |
| 26030 | 0 |
| 26031 | 0 |
| 26032 | 0 |
| 26033 | 0 |
| 26034 | 0 |
| 26035 | 0 |
| 26036 | 0 |
| 26037 | 1023 |
| 26038 | 1023 |
| 26039 | 1023 |
| 26040 | 1023 |
| 26041 | 1023 |
| 26042 | 1023 |
| 26043 | 1023 |
| 26044 | 1023 |
| 26045 | 1023 |
| 26046 | 1023 |
| 26047 | 1023 |
| 26048 | 1023 |
| 26049 | 1023 |
| 26050 | 1023 |
| 26051 | 1023 |
| 26052 | 1023 |
| 26053 | 1023 |
| 26054 | 1023 |
| 26055 | 1023 |
| 26056 | 1023 |
| 26057 | 1023 |
| 26058 | 1023 |
| 26059 | 1023 |
| 26060 | 1023 |
| 26061 | 1023 |
| 26062 | 1023 |
| 26063 | 1023 |
| 26064 | 1023 |
| 26065 | 1023 |
| 26066 | 1023 |
| 26067 | 1023 |
| 26068 | 1023 |
| 26069 | 1023 |
| 26070 | 1023 |
| 26071 | 1023 |
| 26072 | 1023 |
| 26073 | 1023 |
| 26074 | 0 |
| 26075 | 0 |
| 26076 | 0 |
| 26077 | 0 |
| 26078 | 0 |
| 26079 | 0 |
| 26080 | 0 |
| 26081 | 0 |
| 26082 | 0 |
| 26083 | 0 |
| 26084 | 0 |
| 26085 | 0 |
| 26086 | 0 |
| 26087 | 0 |
| 26088 | 0 |
| 26089 | 1023 |
| 26090 | 1023 |
| 26091 | 1023 |
| 26092 | 1023 |
| 26093 | 1023 |
| 26094 | 1023 |
| 26095 | 1023 |
| 26096 | 1023 |
| 26097 | 1023 |
| 26098 | 1023 |
| 26099 | 1023 |
| 26100 | 1023 |
| 26101 | 1023 |
| 26102 | 1023 |
| 26103 | 1023 |
| 26104 | 1023 |
| 26105 | 1023 |
| 26106 | 1023 |
| 26107 | 1023 |
| 26108 | 1023 |
| 26109 | 1023 |
| 26110 | 1023 |
| 26111 | 1023 |
| 26112 | 1023 |
| 26113 | 1023 |
| 26114 | 1023 |
| 26115 | 1023 |
| 26116 | 1023 |
| 26117 | 1023 |
| 26118 | 1023 |
| 26119 | 1023 |
| 26120 | 1023 |
| 26121 | 1023 |
| 26122 | 1023 |
| 26123 | 1023 |
| 26124 | 1023 |
| 26125 | 1023 |
| 26126 | 0 |
| 26127 | 0 |
| 26128 | 0 |
| 26129 | 0 |
| 26130 | 0 |
| 26131 | 0 |
| 26132 | 0 |
| 26133 | 0 |
| 26134 | 0 |
| 26135 | 0 |
| 26136 | 0 |
| 26137 | 0 |
| 26138 | 0 |
| 26139 | 0 |
| 26140 | 0 |
| 26141 | 1023 |
| 26142 | 1023 |
| 26143 | 1023 |
| 26144 | 1023 |
| 26145 | 1023 |
| 26146 | 1023 |
| 26147 | 1023 |
| 26148 | 1023 |
| 26149 | 1023 |
| 26150 | 1023 |
| 26151 | 1023 |
| 26152 | 1023 |
| 26153 | 1023 |
| 26154 | 1023 |
| 26155 | 1023 |
| 26156 | 1023 |
| 26157 | 1023 |
| 26158 | 1023 |
| 26159 | 1023 |
| 26160 | 1023 |
| 26161 | 1023 |
| 26162 | 1023 |
| 26163 | 1023 |
| 26164 | 1023 |
| 26165 | 1023 |
| 26166 | 1023 |
| 26167 | 1023 |
| 26168 | 1023 |
| 26169 | 1023 |
| 26170 | 1023 |
| 26171 | 1023 |
| 26172 | 1023 |
| 26173 | 1023 |
| 26174 | 1023 |
| 26175 | 1023 |
| 26176 | 1023 |
| 26177 | 1023 |
| 26178 | 0 |
| 26179 | 0 |
| 26180 | 0 |
| 26181 | 0 |
| 26182 | 0 |
| 26183 | 0 |
| 26184 | 0 |
| 26185 | 0 |
| 26186 | 0 |
| 26187 | 0 |
| 26188 | 0 |
| 26189 | 0 |
| 26190 | 0 |
| 26191 | 0 |
| 26192 | 0 |
| 26193 | 1023 |
| 26194 | 1023 |
| 26195 | 1023 |
| 26196 | 1023 |
| 26197 | 1023 |
| 26198 | 1023 |
| 26199 | 1023 |
| 26200 | 1023 |
| 26201 | 1023 |
| 26202 | 1023 |
| 26203 | 1023 |
| 26204 | 1023 |
| 26205 | 1023 |
| 26206 | 1023 |
| 26207 | 1023 |
| 26208 | 1023 |
| 26209 | 1023 |
| 26210 | 1023 |
| 26211 | 1023 |
| 26212 | 1023 |
| 26213 | 1023 |
| 26214 | 1023 |
| 26215 | 1023 |
| 26216 | 1023 |
| 26217 | 1023 |
| 26218 | 1023 |
| 26219 | 1023 |
| 26220 | 1023 |
| 26221 | 1023 |
| 26222 | 1023 |
| 26223 | 1023 |
| 26224 | 1023 |
| 26225 | 1023 |
| 26226 | 1023 |
| 26227 | 1023 |
| 26228 | 1023 |
| 26229 | 1023 |
| 26230 | 0 |
| 26231 | 0 |
| 26232 | 0 |
| 26233 | 0 |
| 26234 | 0 |
| 26235 | 0 |
| 26236 | 0 |
| 26237 | 0 |
| 26238 | 0 |
| 26239 | 0 |
| 26240 | 0 |
| 26241 | 0 |
| 26242 | 0 |
| 26243 | 0 |
| 26244 | 0 |
| 26245 | 1023 |
| 26246 | 1023 |
| 26247 | 1023 |
| 26248 | 1023 |
| 26249 | 1023 |
| 26250 | 1023 |
| 26251 | 1023 |
| 26252 | 1023 |
| 26253 | 1023 |
| 26254 | 1023 |
| 26255 | 1023 |
| 26256 | 1023 |
| 26257 | 1023 |
| 26258 | 1023 |
| 26259 | 1023 |
| 26260 | 1023 |
| 26261 | 1023 |
| 26262 | 1023 |
| 26263 | 1023 |
| 26264 | 1023 |
| 26265 | 1023 |
| 26266 | 1023 |
| 26267 | 1023 |
| 26268 | 1023 |
| 26269 | 1023 |
| 26270 | 1023 |
| 26271 | 1023 |
| 26272 | 1023 |
| 26273 | 1023 |
| 26274 | 1023 |
| 26275 | 1023 |
| 26276 | 1023 |
| 26277 | 1023 |
| 26278 | 1023 |
| 26279 | 1023 |
| 26280 | 1023 |
| 26281 | 1023 |
| 26282 | 1023 |
| 26283 | 0 |
| 26284 | 0 |
| 26285 | 0 |
| 26286 | 0 |
| 26287 | 0 |
| 26288 | 0 |
| 26289 | 0 |
| 26290 | 0 |
| 26291 | 0 |
| 26292 | 0 |
| 26293 | 0 |
| 26294 | 0 |
| 26295 | 0 |
| 26296 | 1023 |
| 26297 | 1023 |
| 26298 | 1023 |
| 26299 | 1023 |
| 26300 | 1023 |
| 26301 | 1023 |
| 26302 | 1023 |
| 26303 | 1023 |
| 26304 | 1023 |
| 26305 | 1023 |
| 26306 | 1023 |
| 26307 | 1023 |
| 26308 | 1023 |
| 26309 | 1023 |
| 26310 | 1023 |
| 26311 | 1023 |
| 26312 | 1023 |
| 26313 | 1023 |
| 26314 | 1023 |
| 26315 | 1023 |
| 26316 | 1023 |
| 26317 | 1023 |
| 26318 | 1023 |
| 26319 | 1023 |
| 26320 | 1023 |
| 26321 | 1023 |
| 26322 | 1023 |
| 26323 | 1023 |
| 26324 | 1023 |
| 26325 | 1023 |
| 26326 | 1023 |
| 26327 | 1023 |
| 26328 | 1023 |
| 26329 | 1023 |
| 26330 | 1023 |
| 26331 | 1023 |
| 26332 | 1023 |
| 26333 | 1023 |
| 26334 | 0 |
| 26335 | 0 |
| 26336 | 0 |
| 26337 | 1 |
| 26338 | 0 |
| 26339 | 0 |
| 26340 | 1 |
| 26341 | 0 |
| 26342 | 0 |
| 26343 | 0 |
| 26344 | 0 |
| 26345 | 0 |
| 26346 | 0 |
| 26347 | 1023 |
| 26348 | 1023 |
| 26349 | 1023 |
| 26350 | 1023 |
| 26351 | 1023 |
| 26352 | 1023 |
| 26353 | 1023 |
| 26354 | 1023 |
| 26355 | 1023 |
| 26356 | 1023 |
| 26357 | 1023 |
| 26358 | 1023 |
| 26359 | 1023 |
| 26360 | 1023 |
| 26361 | 1023 |
| 26362 | 1023 |
| 26363 | 1023 |
| 26364 | 1023 |
| 26365 | 1023 |
| 26366 | 1023 |
| 26367 | 1023 |
| 26368 | 1023 |
| 26369 | 1023 |
| 26370 | 1023 |
| 26371 | 1023 |
| 26372 | 1023 |
| 26373 | 1023 |
| 26374 | 1023 |
| 26375 | 1023 |
| 26376 | 1023 |
| 26377 | 1023 |
| 26378 | 1023 |
| 26379 | 1023 |
| 26380 | 1023 |
| 26381 | 1023 |
| 26382 | 1023 |
| 26383 | 1023 |
| 26384 | 1023 |
| 26385 | 1 |
| 26386 | 0 |
| 26387 | 0 |
| 26388 | 0 |
| 26389 | 0 |
| 26390 | 0 |
| 26391 | 0 |
| 26392 | 0 |
| 26393 | 0 |
| 26394 | 0 |
| 26395 | 0 |
| 26396 | 0 |
| 26397 | 0 |
| 26398 | 1023 |
| 26399 | 1023 |
| 26400 | 1023 |
| 26401 | 1023 |
| 26402 | 1023 |
| 26403 | 1023 |
| 26404 | 1023 |
| 26405 | 1023 |
| 26406 | 1023 |
| 26407 | 1023 |
| 26408 | 1023 |
| 26409 | 1023 |
| 26410 | 1023 |
| 26411 | 1023 |
| 26412 | 1023 |
| 26413 | 1023 |
| 26414 | 1023 |
| 26415 | 1023 |
| 26416 | 1023 |
| 26417 | 1023 |
| 26418 | 1023 |
| 26419 | 1023 |
| 26420 | 1023 |
| 26421 | 1023 |
| 26422 | 1023 |
| 26423 | 1023 |
| 26424 | 1023 |
| 26425 | 1023 |
| 26426 | 1023 |
| 26427 | 1023 |
| 26428 | 1023 |
| 26429 | 1023 |
| 26430 | 1023 |
| 26431 | 1023 |
| 26432 | 1023 |
| 26433 | 1023 |
| 26434 | 1023 |
| 26435 | 1023 |
| 26436 | 0 |
| 26437 | 0 |
| 26438 | 0 |
| 26439 | 0 |
| 26440 | 0 |
| 26441 | 0 |
| 26442 | 0 |
| 26443 | 0 |
| 26444 | 0 |
| 26445 | 0 |
| 26446 | 0 |
| 26447 | 0 |
| 26448 | 0 |
| 26449 | 1023 |
| 26450 | 1023 |
| 26451 | 1023 |
| 26452 | 1023 |
| 26453 | 1023 |
| 26454 | 1023 |
| 26455 | 1023 |
| 26456 | 1023 |
| 26457 | 1023 |
| 26458 | 1023 |
| 26459 | 1023 |
| 26460 | 1023 |
| 26461 | 1023 |
| 26462 | 1023 |
| 26463 | 1023 |
| 26464 | 1023 |
| 26465 | 1023 |
| 26466 | 1023 |
| 26467 | 1023 |
| 26468 | 1023 |
| 26469 | 1023 |
| 26470 | 1023 |
| 26471 | 1023 |
| 26472 | 1023 |
| 26473 | 1023 |
| 26474 | 1023 |
| 26475 | 1023 |
| 26476 | 1023 |
| 26477 | 1023 |
| 26478 | 1023 |
| 26479 | 1023 |
| 26480 | 1023 |
| 26481 | 1023 |
| 26482 | 1023 |
| 26483 | 1023 |
| 26484 | 1023 |
| 26485 | 1023 |
| 26486 | 1023 |
| 26487 | 0 |
| 26488 | 0 |
| 26489 | 0 |
| 26490 | 0 |
| 26491 | 0 |
| 26492 | 0 |
| 26493 | 0 |
| 26494 | 0 |
| 26495 | 0 |
| 26496 | 0 |
| 26497 | 0 |
| 26498 | 0 |
| 26499 | 0 |
| 26500 | 1023 |
| 26501 | 1023 |
| 26502 | 1023 |
| 26503 | 1023 |
| 26504 | 1023 |
| 26505 | 1023 |
| 26506 | 1023 |
| 26507 | 1023 |
| 26508 | 1023 |
| 26509 | 1023 |
| 26510 | 1023 |
| 26511 | 1023 |
| 26512 | 1023 |
| 26513 | 1023 |
| 26514 | 1023 |
| 26515 | 1023 |
| 26516 | 1023 |
| 26517 | 1023 |
| 26518 | 1023 |
| 26519 | 1023 |
| 26520 | 1023 |
| 26521 | 1023 |
| 26522 | 1023 |
| 26523 | 1023 |
| 26524 | 1023 |
| 26525 | 1023 |
| 26526 | 1023 |
| 26527 | 1023 |
| 26528 | 1023 |
| 26529 | 1023 |
| 26530 | 1023 |
| 26531 | 1023 |
| 26532 | 1023 |
| 26533 | 1023 |
| 26534 | 1023 |
| 26535 | 1023 |
| 26536 | 1023 |
| 26537 | 1023 |
| 26538 | 0 |
| 26539 | 0 |
| 26540 | 0 |
| 26541 | 0 |
| 26542 | 0 |
| 26543 | 0 |
| 26544 | 0 |
| 26545 | 0 |
| 26546 | 0 |
| 26547 | 0 |
| 26548 | 0 |
| 26549 | 0 |
| 26550 | 1 |
| 26551 | 0 |
| 26552 | 1023 |
| 26553 | 1023 |
| 26554 | 1023 |
| 26555 | 1023 |
| 26556 | 1023 |
| 26557 | 1023 |
| 26558 | 1023 |
| 26559 | 1023 |
| 26560 | 1023 |
| 26561 | 1023 |
| 26562 | 1023 |
| 26563 | 1023 |
| 26564 | 1023 |
| 26565 | 1023 |
| 26566 | 1023 |
| 26567 | 1023 |
| 26568 | 1023 |
| 26569 | 1023 |
| 26570 | 1023 |
| 26571 | 1023 |
| 26572 | 1023 |
| 26573 | 1023 |
| 26574 | 1023 |
| 26575 | 1023 |
| 26576 | 1023 |
| 26577 | 1023 |
| 26578 | 1023 |
| 26579 | 1023 |
| 26580 | 1023 |
| 26581 | 1023 |
| 26582 | 1023 |
| 26583 | 1023 |
| 26584 | 1023 |
| 26585 | 1023 |
| 26586 | 1023 |
| 26587 | 1023 |
| 26588 | 1023 |
| 26589 | 0 |
| 26590 | 0 |
| 26591 | 0 |
| 26592 | 0 |
| 26593 | 0 |
| 26594 | 0 |
| 26595 | 0 |
| 26596 | 0 |
| 26597 | 0 |
| 26598 | 0 |
| 26599 | 0 |
| 26600 | 0 |
| 26601 | 0 |
| 26602 | 0 |
| 26603 | 1023 |
| 26604 | 1023 |
| 26605 | 1023 |
| 26606 | 1023 |
| 26607 | 1023 |
| 26608 | 1023 |
| 26609 | 1023 |
| 26610 | 1023 |
| 26611 | 1023 |
| 26612 | 1023 |
| 26613 | 1023 |
| 26614 | 1023 |
| 26615 | 1023 |
| 26616 | 1023 |
| 26617 | 1023 |
| 26618 | 1023 |
| 26619 | 1023 |
| 26620 | 1023 |
| 26621 | 1023 |
| 26622 | 1023 |
| 26623 | 1023 |
| 26624 | 1023 |
| 26625 | 1023 |
| 26626 | 1023 |
| 26627 | 1023 |
| 26628 | 1023 |
| 26629 | 1023 |
| 26630 | 1023 |
| 26631 | 1023 |
| 26632 | 1023 |
| 26633 | 1023 |
| 26634 | 1023 |
| 26635 | 1023 |
| 26636 | 1023 |
| 26637 | 1023 |
| 26638 | 1023 |
| 26639 | 1023 |
| 26640 | 1023 |
| 26641 | 0 |
| 26642 | 0 |
| 26643 | 0 |
| 26644 | 0 |
| 26645 | 0 |
| 26646 | 0 |
| 26647 | 0 |
| 26648 | 0 |
| 26649 | 0 |
| 26650 | 0 |
| 26651 | 0 |
| 26652 | 0 |
| 26653 | 0 |
| 26654 | 0 |
| 26655 | 1023 |
| 26656 | 1023 |
| 26657 | 1023 |
| 26658 | 1023 |
| 26659 | 1023 |
| 26660 | 1023 |
| 26661 | 1023 |
| 26662 | 1023 |
| 26663 | 1023 |
| 26664 | 1023 |
| 26665 | 1023 |
| 26666 | 1023 |
| 26667 | 1023 |
| 26668 | 1023 |
| 26669 | 1023 |
| 26670 | 1023 |
| 26671 | 1023 |
| 26672 | 1023 |
| 26673 | 1023 |
| 26674 | 1023 |
| 26675 | 1023 |
| 26676 | 1023 |
| 26677 | 1023 |
| 26678 | 1023 |
| 26679 | 1023 |
| 26680 | 1023 |
| 26681 | 1023 |
| 26682 | 1023 |
| 26683 | 1023 |
| 26684 | 1023 |
| 26685 | 1023 |
| 26686 | 1023 |
| 26687 | 1023 |
| 26688 | 1023 |
| 26689 | 1023 |
| 26690 | 1023 |
| 26691 | 1023 |
| 26692 | 0 |
| 26693 | 0 |
| 26694 | 0 |
| 26695 | 0 |
| 26696 | 0 |
| 26697 | 0 |
| 26698 | 0 |
| 26699 | 0 |
| 26700 | 0 |
| 26701 | 0 |
| 26702 | 0 |
| 26703 | 0 |
| 26704 | 0 |
| 26705 | 0 |
| 26706 | 0 |
| 26707 | 1023 |
| 26708 | 1023 |
| 26709 | 1023 |
| 26710 | 1023 |
| 26711 | 1023 |
| 26712 | 1023 |
| 26713 | 1023 |
| 26714 | 1023 |
| 26715 | 1023 |
| 26716 | 1023 |
| 26717 | 1023 |
| 26718 | 1023 |
| 26719 | 1023 |
| 26720 | 1023 |
| 26721 | 1023 |
| 26722 | 1023 |
| 26723 | 1023 |
| 26724 | 1023 |
| 26725 | 1023 |
| 26726 | 1023 |
| 26727 | 1023 |
| 26728 | 1023 |
| 26729 | 1023 |
| 26730 | 1023 |
| 26731 | 1023 |
| 26732 | 1023 |
| 26733 | 1023 |
| 26734 | 1023 |
| 26735 | 1023 |
| 26736 | 1023 |
| 26737 | 1023 |
| 26738 | 1023 |
| 26739 | 1023 |
| 26740 | 1023 |
| 26741 | 1023 |
| 26742 | 1023 |
| 26743 | 1023 |
| 26744 | 0 |
| 26745 | 0 |
| 26746 | 0 |
| 26747 | 0 |
| 26748 | 0 |
| 26749 | 0 |
| 26750 | 0 |
| 26751 | 0 |
| 26752 | 0 |
| 26753 | 0 |
| 26754 | 0 |
| 26755 | 0 |
| 26756 | 0 |
| 26757 | 0 |
| 26758 | 0 |
| 26759 | 1023 |
| 26760 | 1023 |
| 26761 | 1023 |
| 26762 | 1023 |
| 26763 | 1023 |
| 26764 | 1023 |
| 26765 | 1023 |
| 26766 | 1023 |
| 26767 | 1023 |
| 26768 | 1023 |
| 26769 | 1023 |
| 26770 | 1023 |
| 26771 | 1023 |
| 26772 | 1023 |
| 26773 | 1023 |
| 26774 | 1023 |
| 26775 | 1023 |
| 26776 | 1023 |
| 26777 | 1023 |
| 26778 | 1023 |
| 26779 | 1023 |
| 26780 | 1023 |
| 26781 | 1023 |
| 26782 | 1023 |
| 26783 | 1023 |
| 26784 | 1023 |
| 26785 | 1023 |
| 26786 | 1023 |
| 26787 | 1023 |
| 26788 | 1023 |
| 26789 | 1023 |
| 26790 | 1023 |
| 26791 | 1023 |
| 26792 | 1023 |
| 26793 | 1023 |
| 26794 | 1023 |
| 26795 | 1023 |
| 26796 | 0 |
| 26797 | 0 |
| 26798 | 0 |
| 26799 | 0 |
| 26800 | 0 |
| 26801 | 0 |
| 26802 | 0 |
| 26803 | 0 |
| 26804 | 0 |
| 26805 | 0 |
| 26806 | 0 |
| 26807 | 0 |
| 26808 | 0 |
| 26809 | 0 |
| 26810 | 0 |
| 26811 | 1023 |
| 26812 | 1023 |
| 26813 | 1023 |
| 26814 | 1023 |
| 26815 | 1023 |
| 26816 | 1023 |
| 26817 | 1023 |
| 26818 | 1023 |
| 26819 | 1023 |
| 26820 | 1023 |
| 26821 | 1023 |
| 26822 | 1023 |
| 26823 | 1023 |
| 26824 | 1023 |
| 26825 | 1023 |
| 26826 | 1023 |
| 26827 | 1023 |
| 26828 | 1023 |
| 26829 | 1023 |
| 26830 | 1023 |
| 26831 | 1023 |
| 26832 | 1023 |
| 26833 | 1023 |
| 26834 | 1023 |
| 26835 | 1023 |
| 26836 | 1023 |
| 26837 | 1023 |
| 26838 | 1023 |
| 26839 | 1023 |
| 26840 | 1023 |
| 26841 | 1023 |
| 26842 | 1023 |
| 26843 | 1023 |
| 26844 | 1023 |
| 26845 | 1023 |
| 26846 | 1023 |
| 26847 | 1023 |
| 26848 | 1023 |
| 26849 | 0 |
| 26850 | 0 |
| 26851 | 0 |
| 26852 | 0 |
| 26853 | 0 |
| 26854 | 0 |
| 26855 | 0 |
| 26856 | 0 |
| 26857 | 0 |
| 26858 | 0 |
| 26859 | 0 |
| 26860 | 0 |
| 26861 | 0 |
| 26862 | 1023 |
| 26863 | 1023 |
| 26864 | 1023 |
| 26865 | 1023 |
| 26866 | 1023 |
| 26867 | 1023 |
| 26868 | 1023 |
| 26869 | 1023 |
| 26870 | 1023 |
| 26871 | 1023 |
| 26872 | 1023 |
| 26873 | 1023 |
| 26874 | 1023 |
| 26875 | 1023 |
| 26876 | 1023 |
| 26877 | 1023 |
| 26878 | 1023 |
| 26879 | 1023 |
| 26880 | 1023 |
| 26881 | 1023 |
| 26882 | 1023 |
| 26883 | 1023 |
| 26884 | 1023 |
| 26885 | 1023 |
| 26886 | 1023 |
| 26887 | 1023 |
| 26888 | 1023 |
| 26889 | 1023 |
| 26890 | 1023 |
| 26891 | 1023 |
| 26892 | 1023 |
| 26893 | 1023 |
| 26894 | 1023 |
| 26895 | 1023 |
| 26896 | 1023 |
| 26897 | 1023 |
| 26898 | 1023 |
| 26899 | 1023 |
| 26900 | 0 |
| 26901 | 0 |
| 26902 | 0 |
| 26903 | 0 |
| 26904 | 0 |
| 26905 | 0 |
| 26906 | 0 |
| 26907 | 0 |
| 26908 | 0 |
| 26909 | 0 |
| 26910 | 0 |
| 26911 | 0 |
| 26912 | 0 |
| 26913 | 1023 |
| 26914 | 1023 |
| 26915 | 1023 |
| 26916 | 1023 |
| 26917 | 1023 |
| 26918 | 1023 |
| 26919 | 1023 |
| 26920 | 1023 |
| 26921 | 1023 |
| 26922 | 1023 |
| 26923 | 1023 |
| 26924 | 1023 |
| 26925 | 1023 |
| 26926 | 1023 |
| 26927 | 1023 |
| 26928 | 1023 |
| 26929 | 1023 |
| 26930 | 1023 |
| 26931 | 1023 |
| 26932 | 1023 |
| 26933 | 1023 |
| 26934 | 1023 |
| 26935 | 1023 |
| 26936 | 1023 |
| 26937 | 1023 |
| 26938 | 1023 |
| 26939 | 1023 |
| 26940 | 1023 |
| 26941 | 1023 |
| 26942 | 1023 |
| 26943 | 1023 |
| 26944 | 1023 |
| 26945 | 1023 |
| 26946 | 1023 |
| 26947 | 1023 |
| 26948 | 1023 |
| 26949 | 1023 |
| 26950 | 1023 |
| 26951 | 0 |
| 26952 | 0 |
| 26953 | 0 |
| 26954 | 0 |
| 26955 | 0 |
| 26956 | 0 |
| 26957 | 0 |
| 26958 | 0 |
| 26959 | 0 |
| 26960 | 0 |
| 26961 | 0 |
| 26962 | 0 |
| 26963 | 0 |
| 26964 | 1023 |
| 26965 | 1023 |
| 26966 | 1023 |
| 26967 | 1023 |
| 26968 | 1023 |
| 26969 | 1023 |
| 26970 | 1023 |
| 26971 | 1023 |
| 26972 | 1023 |
| 26973 | 1023 |
| 26974 | 1023 |
| 26975 | 1023 |
| 26976 | 1023 |
| 26977 | 1023 |
| 26978 | 1023 |
| 26979 | 1023 |
| 26980 | 1023 |
| 26981 | 1023 |
| 26982 | 1023 |
| 26983 | 1023 |
| 26984 | 1023 |
| 26985 | 1023 |
| 26986 | 1023 |
| 26987 | 1023 |
| 26988 | 1023 |
| 26989 | 1023 |
| 26990 | 1023 |
| 26991 | 1023 |
| 26992 | 1023 |
| 26993 | 1023 |
| 26994 | 1023 |
| 26995 | 1023 |
| 26996 | 1023 |
| 26997 | 1023 |
| 26998 | 1023 |
| 26999 | 1023 |
| 27000 | 1023 |
| 27001 | 1023 |
| 27002 | 0 |
| 27003 | 0 |
| 27004 | 0 |
| 27005 | 0 |
| 27006 | 0 |
| 27007 | 0 |
| 27008 | 0 |
| 27009 | 0 |
| 27010 | 0 |
| 27011 | 0 |
| 27012 | 0 |
| 27013 | 0 |
| 27014 | 0 |
| 27015 | 1023 |
| 27016 | 1023 |
| 27017 | 1023 |
| 27018 | 1023 |
| 27019 | 1023 |
| 27020 | 1023 |
| 27021 | 1023 |
| 27022 | 1023 |
| 27023 | 1023 |
| 27024 | 1023 |
| 27025 | 1023 |
| 27026 | 1023 |
| 27027 | 1023 |
| 27028 | 1023 |
| 27029 | 1023 |
| 27030 | 1023 |
| 27031 | 1023 |
| 27032 | 1023 |
| 27033 | 1023 |
| 27034 | 1023 |
| 27035 | 1023 |
| 27036 | 1023 |
| 27037 | 1023 |
| 27038 | 1023 |
| 27039 | 1023 |
| 27040 | 1023 |
| 27041 | 1023 |
| 27042 | 1023 |
| 27043 | 1023 |
| 27044 | 1023 |
| 27045 | 1023 |
| 27046 | 1023 |
| 27047 | 1023 |
| 27048 | 1023 |
| 27049 | 1023 |
| 27050 | 1023 |
| 27051 | 1023 |
| 27052 | 1023 |
| 27053 | 0 |
| 27054 | 0 |
| 27055 | 0 |
| 27056 | 0 |
| 27057 | 0 |
| 27058 | 0 |
| 27059 | 0 |
| 27060 | 0 |
| 27061 | 0 |
| 27062 | 0 |
| 27063 | 0 |
| 27064 | 0 |
| 27065 | 0 |
| 27066 | 1023 |
| 27067 | 1023 |
| 27068 | 1023 |
| 27069 | 1023 |
| 27070 | 1023 |
| 27071 | 1023 |
| 27072 | 1023 |
| 27073 | 1023 |
| 27074 | 1023 |
| 27075 | 1023 |
| 27076 | 1023 |
| 27077 | 1023 |
| 27078 | 1023 |
| 27079 | 1023 |
| 27080 | 1023 |
| 27081 | 1023 |
| 27082 | 1023 |
| 27083 | 1023 |
| 27084 | 1023 |
| 27085 | 1023 |
| 27086 | 1023 |
| 27087 | 1023 |
| 27088 | 1023 |
| 27089 | 1023 |
| 27090 | 1023 |
| 27091 | 1023 |
| 27092 | 1023 |
| 27093 | 1023 |
| 27094 | 1023 |
| 27095 | 1023 |
| 27096 | 1023 |
| 27097 | 1023 |
| 27098 | 1023 |
| 27099 | 1023 |
| 27100 | 1023 |
| 27101 | 1023 |
| 27102 | 1023 |
| 27103 | 1023 |
| 27104 | 0 |
| 27105 | 0 |
| 27106 | 0 |
| 27107 | 0 |
| 27108 | 0 |
| 27109 | 0 |
| 27110 | 0 |
| 27111 | 0 |
| 27112 | 0 |
| 27113 | 0 |
| 27114 | 0 |
| 27115 | 0 |
| 27116 | 0 |
| 27117 | 1023 |
| 27118 | 1023 |
| 27119 | 1023 |
| 27120 | 1023 |
| 27121 | 1023 |
| 27122 | 1023 |
| 27123 | 1023 |
| 27124 | 1023 |
| 27125 | 1023 |
| 27126 | 1023 |
| 27127 | 1023 |
| 27128 | 1023 |
| 27129 | 1023 |
| 27130 | 1023 |
| 27131 | 1023 |
| 27132 | 1023 |
| 27133 | 1023 |
| 27134 | 1023 |
| 27135 | 1023 |
| 27136 | 1023 |
| 27137 | 1023 |
| 27138 | 1023 |
| 27139 | 1023 |
| 27140 | 1023 |
| 27141 | 1023 |
| 27142 | 1023 |
| 27143 | 1023 |
| 27144 | 1023 |
| 27145 | 1023 |
| 27146 | 1023 |
| 27147 | 1023 |
| 27148 | 1023 |
| 27149 | 1023 |
| 27150 | 1023 |
| 27151 | 1023 |
| 27152 | 1023 |
| 27153 | 1023 |
| 27154 | 1023 |
| 27155 | 0 |
| 27156 | 0 |
| 27157 | 0 |
| 27158 | 0 |
| 27159 | 0 |
| 27160 | 0 |
| 27161 | 0 |
| 27162 | 0 |
| 27163 | 0 |
| 27164 | 0 |
| 27165 | 0 |
| 27166 | 0 |
| 27167 | 0 |
| 27168 | 0 |
| 27169 | 1023 |
| 27170 | 1023 |
| 27171 | 1023 |
| 27172 | 1023 |
| 27173 | 1023 |
| 27174 | 1023 |
| 27175 | 1023 |
| 27176 | 1023 |
| 27177 | 1023 |
| 27178 | 1023 |
| 27179 | 1023 |
| 27180 | 1023 |
| 27181 | 1023 |
| 27182 | 1023 |
| 27183 | 1023 |
| 27184 | 1023 |
| 27185 | 1023 |
| 27186 | 1023 |
| 27187 | 1023 |
| 27188 | 1023 |
| 27189 | 1023 |
| 27190 | 1023 |
| 27191 | 1023 |
| 27192 | 1023 |
| 27193 | 1023 |
| 27194 | 1023 |
| 27195 | 1023 |
| 27196 | 1023 |
| 27197 | 1023 |
| 27198 | 1023 |
| 27199 | 1023 |
| 27200 | 1023 |
| 27201 | 1023 |
| 27202 | 1023 |
| 27203 | 1023 |
| 27204 | 1023 |
| 27205 | 1023 |
| 27206 | 0 |
| 27207 | 0 |
| 27208 | 0 |
| 27209 | 0 |
| 27210 | 0 |
| 27211 | 0 |
| 27212 | 0 |
| 27213 | 0 |
| 27214 | 0 |
| 27215 | 0 |
| 27216 | 0 |
| 27217 | 0 |
| 27218 | 0 |
| 27219 | 0 |
| 27220 | 1023 |
| 27221 | 1023 |
| 27222 | 1023 |
| 27223 | 1023 |
| 27224 | 1023 |
| 27225 | 1023 |
| 27226 | 1023 |
| 27227 | 1023 |
| 27228 | 1023 |
| 27229 | 1023 |
| 27230 | 1023 |
| 27231 | 1023 |
| 27232 | 1023 |
| 27233 | 1023 |
| 27234 | 1023 |
| 27235 | 1023 |
| 27236 | 1023 |
| 27237 | 1023 |
| 27238 | 1023 |
| 27239 | 1023 |
| 27240 | 1023 |
| 27241 | 1023 |
| 27242 | 1023 |
| 27243 | 1023 |
| 27244 | 1023 |
| 27245 | 1023 |
| 27246 | 1023 |
| 27247 | 1023 |
| 27248 | 1023 |
| 27249 | 1023 |
| 27250 | 1023 |
| 27251 | 1023 |
| 27252 | 1023 |
| 27253 | 1023 |
| 27254 | 1023 |
| 27255 | 1023 |
| 27256 | 1023 |
| 27257 | 1023 |
| 27258 | 0 |
| 27259 | 0 |
| 27260 | 0 |
| 27261 | 0 |
| 27262 | 0 |
| 27263 | 0 |
| 27264 | 0 |
| 27265 | 0 |
| 27266 | 0 |
| 27267 | 0 |
| 27268 | 0 |
| 27269 | 0 |
| 27270 | 0 |
| 27271 | 0 |
| 27272 | 1023 |
| 27273 | 1023 |
| 27274 | 1023 |
| 27275 | 1023 |
| 27276 | 1023 |
| 27277 | 1023 |
| 27278 | 1023 |
| 27279 | 1023 |
| 27280 | 1023 |
| 27281 | 1023 |
| 27282 | 1023 |
| 27283 | 1023 |
| 27284 | 1023 |
| 27285 | 1023 |
| 27286 | 1023 |
| 27287 | 1023 |
| 27288 | 1023 |
| 27289 | 1023 |
| 27290 | 1023 |
| 27291 | 1023 |
| 27292 | 1023 |
| 27293 | 1023 |
| 27294 | 1023 |
| 27295 | 1023 |
| 27296 | 1023 |
| 27297 | 1023 |
| 27298 | 1023 |
| 27299 | 1023 |
| 27300 | 1023 |
| 27301 | 1023 |
| 27302 | 1023 |
| 27303 | 1023 |
| 27304 | 1023 |
| 27305 | 1023 |
| 27306 | 1023 |
| 27307 | 1023 |
| 27308 | 1023 |
| 27309 | 0 |
| 27310 | 0 |
| 27311 | 0 |
| 27312 | 0 |
| 27313 | 0 |
| 27314 | 0 |
| 27315 | 0 |
| 27316 | 0 |
| 27317 | 0 |
| 27318 | 0 |
| 27319 | 0 |
| 27320 | 0 |
| 27321 | 0 |
| 27322 | 0 |
| 27323 | 0 |
| 27324 | 1023 |
| 27325 | 1023 |
| 27326 | 1023 |
| 27327 | 1023 |
| 27328 | 1023 |
| 27329 | 1023 |
| 27330 | 1023 |
| 27331 | 1023 |
| 27332 | 1023 |
| 27333 | 1023 |
| 27334 | 1023 |
| 27335 | 1023 |
| 27336 | 1023 |
| 27337 | 1023 |
| 27338 | 1023 |
| 27339 | 1023 |
| 27340 | 1023 |
| 27341 | 1023 |
| 27342 | 1023 |
| 27343 | 1023 |
| 27344 | 1023 |
| 27345 | 1023 |
| 27346 | 1023 |
| 27347 | 1023 |
| 27348 | 1023 |
| 27349 | 1023 |
| 27350 | 1023 |
| 27351 | 1023 |
| 27352 | 1023 |
| 27353 | 1023 |
| 27354 | 1023 |
| 27355 | 1023 |
| 27356 | 1023 |
| 27357 | 1023 |
| 27358 | 1023 |
| 27359 | 1023 |
| 27360 | 1023 |
| 27361 | 0 |
| 27362 | 0 |
| 27363 | 0 |
| 27364 | 0 |
| 27365 | 0 |
| 27366 | 0 |
| 27367 | 0 |
| 27368 | 0 |
| 27369 | 0 |
| 27370 | 0 |
| 27371 | 0 |
| 27372 | 0 |
| 27373 | 0 |
| 27374 | 0 |
| 27375 | 0 |
| 27376 | 1023 |
| 27377 | 1023 |
| 27378 | 1023 |
| 27379 | 1023 |
| 27380 | 1023 |
| 27381 | 1023 |
| 27382 | 1023 |
| 27383 | 1023 |
| 27384 | 1023 |
| 27385 | 1023 |
| 27386 | 1023 |
| 27387 | 1023 |
| 27388 | 1023 |
| 27389 | 1023 |
| 27390 | 1023 |
| 27391 | 1023 |
| 27392 | 1023 |
| 27393 | 1023 |
| 27394 | 1023 |
| 27395 | 1023 |
| 27396 | 1023 |
| 27397 | 1023 |
| 27398 | 1023 |
| 27399 | 1023 |
| 27400 | 1023 |
| 27401 | 1023 |
| 27402 | 1023 |
| 27403 | 1023 |
| 27404 | 1023 |
| 27405 | 1023 |
| 27406 | 1023 |
| 27407 | 1023 |
| 27408 | 1023 |
| 27409 | 1023 |
| 27410 | 1023 |
| 27411 | 1023 |
| 27412 | 1023 |
| 27413 | 0 |
| 27414 | 0 |
| 27415 | 0 |
| 27416 | 0 |
| 27417 | 0 |
| 27418 | 0 |
| 27419 | 0 |
| 27420 | 0 |
| 27421 | 0 |
| 27422 | 0 |
| 27423 | 0 |
| 27424 | 0 |
| 27425 | 0 |
| 27426 | 0 |
| 27427 | 0 |
| 27428 | 1023 |
| 27429 | 1023 |
| 27430 | 1023 |
| 27431 | 1023 |
| 27432 | 1023 |
| 27433 | 1023 |
| 27434 | 1023 |
| 27435 | 1023 |
| 27436 | 1023 |
| 27437 | 1023 |
| 27438 | 1023 |
| 27439 | 1023 |
| 27440 | 1023 |
| 27441 | 1023 |
| 27442 | 1023 |
| 27443 | 1023 |
| 27444 | 1023 |
| 27445 | 1023 |
| 27446 | 1023 |
| 27447 | 1023 |
| 27448 | 1023 |
| 27449 | 1023 |
| 27450 | 1023 |
| 27451 | 1023 |
| 27452 | 1023 |
| 27453 | 1023 |
| 27454 | 1023 |
| 27455 | 1023 |
| 27456 | 1023 |
| 27457 | 1023 |
| 27458 | 1023 |
| 27459 | 1023 |
| 27460 | 1023 |
| 27461 | 1023 |
| 27462 | 1023 |
| 27463 | 1023 |
| 27464 | 1023 |
| 27465 | 1023 |
| 27466 | 0 |
| 27467 | 0 |
| 27468 | 0 |
| 27469 | 0 |
| 27470 | 0 |
| 27471 | 0 |
| 27472 | 0 |
| 27473 | 0 |
| 27474 | 0 |
| 27475 | 0 |
| 27476 | 0 |
| 27477 | 0 |
| 27478 | 0 |
| 27479 | 1023 |
| 27480 | 1023 |
| 27481 | 1023 |
| 27482 | 1023 |
| 27483 | 1023 |
| 27484 | 1023 |
| 27485 | 1023 |
| 27486 | 1023 |
| 27487 | 1023 |
| 27488 | 1023 |
| 27489 | 1023 |
| 27490 | 1023 |
| 27491 | 1023 |
| 27492 | 1023 |
| 27493 | 1023 |
| 27494 | 1023 |
| 27495 | 1023 |
| 27496 | 1023 |
| 27497 | 1023 |
| 27498 | 1023 |
| 27499 | 1023 |
| 27500 | 1023 |
| 27501 | 1023 |
| 27502 | 1023 |
| 27503 | 1023 |
| 27504 | 1023 |
| 27505 | 1023 |
| 27506 | 1023 |
| 27507 | 1023 |
| 27508 | 1023 |
| 27509 | 1023 |
| 27510 | 1023 |
| 27511 | 1023 |
| 27512 | 1023 |
| 27513 | 1023 |
| 27514 | 1023 |
| 27515 | 1023 |
| 27516 | 1023 |
| 27517 | 0 |
| 27518 | 0 |
| 27519 | 0 |
| 27520 | 0 |
| 27521 | 0 |
| 27522 | 0 |
| 27523 | 0 |
| 27524 | 0 |
| 27525 | 0 |
| 27526 | 0 |
| 27527 | 0 |
| 27528 | 0 |
| 27529 | 1 |
| 27530 | 1023 |
| 27531 | 1023 |
| 27532 | 1023 |
| 27533 | 1023 |
| 27534 | 1023 |
| 27535 | 1023 |
| 27536 | 1023 |
| 27537 | 1023 |
| 27538 | 1023 |
| 27539 | 1023 |
| 27540 | 1023 |
| 27541 | 1023 |
| 27542 | 1023 |
| 27543 | 1023 |
| 27544 | 1023 |
| 27545 | 1023 |
| 27546 | 1023 |
| 27547 | 1023 |
| 27548 | 1023 |
| 27549 | 1023 |
| 27550 | 1023 |
| 27551 | 1023 |
| 27552 | 1023 |
| 27553 | 1023 |
| 27554 | 1023 |
| 27555 | 1023 |
| 27556 | 1023 |
| 27557 | 1023 |
| 27558 | 1023 |
| 27559 | 1023 |
| 27560 | 1023 |
| 27561 | 1023 |
| 27562 | 1023 |
| 27563 | 1023 |
| 27564 | 1023 |
| 27565 | 1023 |
| 27566 | 1023 |
| 27567 | 1023 |
| 27568 | 0 |
| 27569 | 0 |
| 27570 | 0 |
| 27571 | 0 |
| 27572 | 0 |
| 27573 | 0 |
| 27574 | 0 |
| 27575 | 0 |
| 27576 | 0 |
| 27577 | 0 |
| 27578 | 0 |
| 27579 | 0 |
| 27580 | 0 |
| 27581 | 1023 |
| 27582 | 1023 |
| 27583 | 1023 |
| 27584 | 1023 |
| 27585 | 1023 |
| 27586 | 1023 |
| 27587 | 1023 |
| 27588 | 1023 |
| 27589 | 1023 |
| 27590 | 1023 |
| 27591 | 1023 |
| 27592 | 1023 |
| 27593 | 1023 |
| 27594 | 1023 |
| 27595 | 1023 |
| 27596 | 1023 |
| 27597 | 1023 |
| 27598 | 1023 |
| 27599 | 1023 |
| 27600 | 1023 |
| 27601 | 1023 |
| 27602 | 1023 |
| 27603 | 1023 |
| 27604 | 1023 |
| 27605 | 1023 |
| 27606 | 1023 |
| 27607 | 1023 |
| 27608 | 1023 |
| 27609 | 1023 |
| 27610 | 1023 |
| 27611 | 1023 |
| 27612 | 1023 |
| 27613 | 1023 |
| 27614 | 1023 |
| 27615 | 1023 |
| 27616 | 1023 |
| 27617 | 1023 |
| 27618 | 1023 |
| 27619 | 0 |
| 27620 | 0 |
| 27621 | 0 |
| 27622 | 0 |
| 27623 | 0 |
| 27624 | 0 |
| 27625 | 0 |
| 27626 | 0 |
| 27627 | 0 |
| 27628 | 0 |
| 27629 | 0 |
| 27630 | 0 |
| 27631 | 0 |
| 27632 | 1023 |
| 27633 | 1023 |
| 27634 | 1023 |
| 27635 | 1023 |
| 27636 | 1023 |
| 27637 | 1023 |
| 27638 | 1023 |
| 27639 | 1023 |
| 27640 | 1023 |
| 27641 | 1023 |
| 27642 | 1023 |
| 27643 | 1023 |
| 27644 | 1023 |
| 27645 | 1023 |
| 27646 | 1023 |
| 27647 | 1023 |
| 27648 | 1023 |
| 27649 | 1023 |
| 27650 | 1023 |
| 27651 | 1023 |
| 27652 | 1023 |
| 27653 | 1023 |
| 27654 | 1023 |
| 27655 | 1023 |
| 27656 | 1023 |
| 27657 | 1023 |
| 27658 | 1023 |
| 27659 | 1023 |
| 27660 | 1023 |
| 27661 | 1023 |
| 27662 | 1023 |
| 27663 | 1023 |
| 27664 | 1023 |
| 27665 | 1023 |
| 27666 | 1023 |
| 27667 | 1023 |
| 27668 | 1023 |
| 27669 | 1023 |
| 27670 | 0 |
| 27671 | 0 |
| 27672 | 0 |
| 27673 | 0 |
| 27674 | 0 |
| 27675 | 0 |
| 27676 | 0 |
| 27677 | 0 |
| 27678 | 0 |
| 27679 | 0 |
| 27680 | 0 |
| 27681 | 0 |
| 27682 | 0 |
| 27683 | 1023 |
| 27684 | 1023 |
| 27685 | 1023 |
| 27686 | 1023 |
| 27687 | 1023 |
| 27688 | 1023 |
| 27689 | 1023 |
| 27690 | 1023 |
| 27691 | 1023 |
| 27692 | 1023 |
| 27693 | 1023 |
| 27694 | 1023 |
| 27695 | 1023 |
| 27696 | 1023 |
| 27697 | 1023 |
| 27698 | 1023 |
| 27699 | 1023 |
| 27700 | 1023 |
| 27701 | 1023 |
| 27702 | 1023 |
| 27703 | 1023 |
| 27704 | 1023 |
| 27705 | 1023 |
| 27706 | 1023 |
| 27707 | 1023 |
| 27708 | 1023 |
| 27709 | 1023 |
| 27710 | 1023 |
| 27711 | 1023 |
| 27712 | 1023 |
| 27713 | 1023 |
| 27714 | 1023 |
| 27715 | 1023 |
| 27716 | 1023 |
| 27717 | 1023 |
| 27718 | 1023 |
| 27719 | 1023 |
| 27720 | 1023 |
| 27721 | 0 |
| 27722 | 0 |
| 27723 | 0 |
| 27724 | 0 |
| 27725 | 0 |
| 27726 | 0 |
| 27727 | 0 |
| 27728 | 0 |
| 27729 | 0 |
| 27730 | 0 |
| 27731 | 0 |
| 27732 | 0 |
| 27733 | 0 |
| 27734 | 1023 |
| 27735 | 1023 |
| 27736 | 1023 |
| 27737 | 1023 |
| 27738 | 1023 |
| 27739 | 1023 |
| 27740 | 1023 |
| 27741 | 1023 |
| 27742 | 1023 |
| 27743 | 1023 |
| 27744 | 1023 |
| 27745 | 1023 |
| 27746 | 1023 |
| 27747 | 1023 |
| 27748 | 1023 |
| 27749 | 1023 |
| 27750 | 1023 |
| 27751 | 1023 |
| 27752 | 1023 |
| 27753 | 1023 |
| 27754 | 1023 |
| 27755 | 1023 |
| 27756 | 1023 |
| 27757 | 1023 |
| 27758 | 1023 |
| 27759 | 1023 |
| 27760 | 1023 |
| 27761 | 1023 |
| 27762 | 1023 |
| 27763 | 1023 |
| 27764 | 1023 |
| 27765 | 1023 |
| 27766 | 1023 |
| 27767 | 1023 |
| 27768 | 1023 |
| 27769 | 1023 |
| 27770 | 1023 |
| 27771 | 1023 |
| 27772 | 0 |
| 27773 | 0 |
| 27774 | 0 |
| 27775 | 0 |
| 27776 | 0 |
| 27777 | 0 |
| 27778 | 0 |
| 27779 | 0 |
| 27780 | 0 |
| 27781 | 0 |
| 27782 | 0 |
| 27783 | 0 |
| 27784 | 0 |
| 27785 | 0 |
| 27786 | 1023 |
| 27787 | 1023 |
| 27788 | 1023 |
| 27789 | 1023 |
| 27790 | 1023 |
| 27791 | 1023 |
| 27792 | 1023 |
| 27793 | 1023 |
| 27794 | 1023 |
| 27795 | 1023 |
| 27796 | 1023 |
| 27797 | 1023 |
| 27798 | 1023 |
| 27799 | 1023 |
| 27800 | 1023 |
| 27801 | 1023 |
| 27802 | 1023 |
| 27803 | 1023 |
| 27804 | 1023 |
| 27805 | 1023 |
| 27806 | 1023 |
| 27807 | 1023 |
| 27808 | 1023 |
| 27809 | 1023 |
| 27810 | 1023 |
| 27811 | 1023 |
| 27812 | 1023 |
| 27813 | 1023 |
| 27814 | 1023 |
| 27815 | 1023 |
| 27816 | 1023 |
| 27817 | 1023 |
| 27818 | 1023 |
| 27819 | 1023 |
| 27820 | 1023 |
| 27821 | 1023 |
| 27822 | 1023 |
| 27823 | 0 |
| 27824 | 0 |
| 27825 | 0 |
| 27826 | 0 |
| 27827 | 0 |
| 27828 | 0 |
| 27829 | 0 |
| 27830 | 0 |
| 27831 | 0 |
| 27832 | 0 |
| 27833 | 0 |
| 27834 | 0 |
| 27835 | 0 |
| 27836 | 0 |
| 27837 | 1023 |
| 27838 | 1023 |
| 27839 | 1023 |
| 27840 | 1023 |
| 27841 | 1023 |
| 27842 | 1023 |
| 27843 | 1023 |
| 27844 | 1023 |
| 27845 | 1023 |
| 27846 | 1023 |
| 27847 | 1023 |
| 27848 | 1023 |
| 27849 | 1023 |
| 27850 | 1023 |
| 27851 | 1023 |
| 27852 | 1023 |
| 27853 | 1023 |
| 27854 | 1023 |
| 27855 | 1023 |
| 27856 | 1023 |
| 27857 | 1023 |
| 27858 | 1023 |
| 27859 | 1023 |
| 27860 | 1023 |
| 27861 | 1023 |
| 27862 | 1023 |
| 27863 | 1023 |
| 27864 | 1023 |
| 27865 | 1023 |
| 27866 | 1023 |
| 27867 | 1023 |
| 27868 | 1023 |
| 27869 | 1023 |
| 27870 | 1023 |
| 27871 | 1023 |
| 27872 | 1023 |
| 27873 | 1023 |
| 27874 | 1023 |
| 27875 | 0 |
| 27876 | 0 |
| 27877 | 0 |
| 27878 | 0 |
| 27879 | 0 |
| 27880 | 0 |
| 27881 | 0 |
| 27882 | 0 |
| 27883 | 0 |
| 27884 | 0 |
| 27885 | 0 |
| 27886 | 0 |
| 27887 | 0 |
| 27888 | 0 |
| 27889 | 1023 |
| 27890 | 1023 |
| 27891 | 1023 |
| 27892 | 1023 |
| 27893 | 1023 |
| 27894 | 1023 |
| 27895 | 1023 |
| 27896 | 1023 |
| 27897 | 1023 |
| 27898 | 1023 |
| 27899 | 1023 |
| 27900 | 1023 |
| 27901 | 1023 |
| 27902 | 1023 |
| 27903 | 1023 |
| 27904 | 1023 |
| 27905 | 1023 |
| 27906 | 1023 |
| 27907 | 1023 |
| 27908 | 1023 |
| 27909 | 1023 |
| 27910 | 1023 |
| 27911 | 1023 |
| 27912 | 1023 |
| 27913 | 1023 |
| 27914 | 1023 |
| 27915 | 1023 |
| 27916 | 1023 |
| 27917 | 1023 |
| 27918 | 1023 |
| 27919 | 1023 |
| 27920 | 1023 |
| 27921 | 1023 |
| 27922 | 1023 |
| 27923 | 1023 |
| 27924 | 1023 |
| 27925 | 1023 |
| 27926 | 0 |
| 27927 | 0 |
| 27928 | 0 |
| 27929 | 0 |
| 27930 | 0 |
| 27931 | 0 |
| 27932 | 0 |
| 27933 | 0 |
| 27934 | 0 |
| 27935 | 0 |
| 27936 | 0 |
| 27937 | 0 |
| 27938 | 0 |
| 27939 | 0 |
| 27940 | 0 |
| 27941 | 1023 |
| 27942 | 1023 |
| 27943 | 1023 |
| 27944 | 1023 |
| 27945 | 1023 |
| 27946 | 1023 |
| 27947 | 1023 |
| 27948 | 1023 |
| 27949 | 1023 |
| 27950 | 1023 |
| 27951 | 1023 |
| 27952 | 1023 |
| 27953 | 1023 |
| 27954 | 1023 |
| 27955 | 1023 |
| 27956 | 1023 |
| 27957 | 1023 |
| 27958 | 1023 |
| 27959 | 1023 |
| 27960 | 1023 |
| 27961 | 1023 |
| 27962 | 1023 |
| 27963 | 1023 |
| 27964 | 1023 |
| 27965 | 1023 |
| 27966 | 1023 |
| 27967 | 1023 |
| 27968 | 1023 |
| 27969 | 1023 |
| 27970 | 1023 |
| 27971 | 1023 |
| 27972 | 1023 |
| 27973 | 1023 |
| 27974 | 1023 |
| 27975 | 1023 |
| 27976 | 1023 |
| 27977 | 1023 |
| 27978 | 0 |
| 27979 | 0 |
| 27980 | 0 |
| 27981 | 0 |
| 27982 | 0 |
| 27983 | 0 |
| 27984 | 0 |
| 27985 | 0 |
| 27986 | 0 |
| 27987 | 0 |
| 27988 | 0 |
| 27989 | 0 |
| 27990 | 0 |
| 27991 | 0 |
| 27992 | 0 |
| 27993 | 1023 |
| 27994 | 1023 |
| 27995 | 1023 |
| 27996 | 1023 |
| 27997 | 1023 |
| 27998 | 1023 |
| 27999 | 1023 |
| 28000 | 1023 |
| 28001 | 1023 |
| 28002 | 1023 |
| 28003 | 1023 |
| 28004 | 1023 |
| 28005 | 1023 |
| 28006 | 1023 |
| 28007 | 1023 |
| 28008 | 1023 |
| 28009 | 1023 |
| 28010 | 1023 |
| 28011 | 1023 |
| 28012 | 1023 |
| 28013 | 1023 |
| 28014 | 1023 |
| 28015 | 1023 |
| 28016 | 1023 |
| 28017 | 1023 |
| 28018 | 1023 |
| 28019 | 1023 |
| 28020 | 1023 |
| 28021 | 1023 |
| 28022 | 1023 |
| 28023 | 1023 |
| 28024 | 1023 |
| 28025 | 1023 |
| 28026 | 1023 |
| 28027 | 1023 |
| 28028 | 1023 |
| 28029 | 1023 |
| 28030 | 0 |
| 28031 | 0 |
| 28032 | 0 |
| 28033 | 0 |
| 28034 | 0 |
| 28035 | 0 |
| 28036 | 0 |
| 28037 | 0 |
| 28038 | 0 |
| 28039 | 0 |
| 28040 | 0 |
| 28041 | 0 |
| 28042 | 0 |
| 28043 | 0 |
| 28044 | 0 |
| 28045 | 1023 |
| 28046 | 1023 |
| 28047 | 1023 |
| 28048 | 1023 |
| 28049 | 1023 |
| 28050 | 1023 |
| 28051 | 1023 |
| 28052 | 1023 |
| 28053 | 1023 |
| 28054 | 1023 |
| 28055 | 1023 |
| 28056 | 1023 |
| 28057 | 1023 |
| 28058 | 1023 |
| 28059 | 1023 |
| 28060 | 1023 |
| 28061 | 1023 |
| 28062 | 1023 |
| 28063 | 1023 |
| 28064 | 1023 |
| 28065 | 1023 |
| 28066 | 1023 |
| 28067 | 1023 |
| 28068 | 1023 |
| 28069 | 1023 |
| 28070 | 1023 |
| 28071 | 1023 |
| 28072 | 1023 |
| 28073 | 1023 |
| 28074 | 1023 |
| 28075 | 1023 |
| 28076 | 1023 |
| 28077 | 1023 |
| 28078 | 1023 |
| 28079 | 1023 |
| 28080 | 1023 |
| 28081 | 1023 |
| 28082 | 0 |
| 28083 | 0 |
| 28084 | 0 |
| 28085 | 0 |
| 28086 | 0 |
| 28087 | 0 |
| 28088 | 0 |
| 28089 | 0 |
| 28090 | 0 |
| 28091 | 0 |
| 28092 | 0 |
| 28093 | 0 |
| 28094 | 0 |
| 28095 | 0 |
| 28096 | 0 |
| 28097 | 1023 |
| 28098 | 1023 |
| 28099 | 1023 |
| 28100 | 1023 |
| 28101 | 1023 |
| 28102 | 1023 |
| 28103 | 1023 |
| 28104 | 1023 |
| 28105 | 1023 |
| 28106 | 1023 |
| 28107 | 1023 |
| 28108 | 1023 |
| 28109 | 1023 |
| 28110 | 1023 |
| 28111 | 1023 |
| 28112 | 1023 |
| 28113 | 1023 |
| 28114 | 1023 |
| 28115 | 1023 |
| 28116 | 1023 |
| 28117 | 1023 |
| 28118 | 1023 |
| 28119 | 1023 |
| 28120 | 1023 |
| 28121 | 1023 |
| 28122 | 1023 |
| 28123 | 1023 |
| 28124 | 1023 |
| 28125 | 1023 |
| 28126 | 1023 |
| 28127 | 1023 |
| 28128 | 1023 |
| 28129 | 1023 |
| 28130 | 1023 |
| 28131 | 1023 |
| 28132 | 1023 |
| 28133 | 1023 |
| 28134 | 1023 |
| 28135 | 0 |
| 28136 | 0 |
| 28137 | 0 |
| 28138 | 0 |
| 28139 | 0 |
| 28140 | 0 |
| 28141 | 0 |
| 28142 | 0 |
| 28143 | 0 |
| 28144 | 0 |
| 28145 | 0 |
| 28146 | 0 |
| 28147 | 0 |
| 28148 | 1023 |
| 28149 | 1023 |
| 28150 | 1023 |
| 28151 | 1023 |
| 28152 | 1023 |
| 28153 | 1023 |
| 28154 | 1023 |
| 28155 | 1023 |
| 28156 | 1023 |
| 28157 | 1023 |
| 28158 | 1023 |
| 28159 | 1023 |
| 28160 | 1023 |
| 28161 | 1023 |
| 28162 | 1023 |
| 28163 | 1023 |
| 28164 | 1023 |
| 28165 | 1023 |
| 28166 | 1023 |
| 28167 | 1023 |
| 28168 | 1023 |
| 28169 | 1023 |
| 28170 | 1023 |
| 28171 | 1023 |
| 28172 | 1023 |
| 28173 | 1023 |
| 28174 | 1023 |
| 28175 | 1023 |
| 28176 | 1023 |
| 28177 | 1023 |
| 28178 | 1023 |
| 28179 | 1023 |
| 28180 | 1023 |
| 28181 | 1023 |
| 28182 | 1023 |
| 28183 | 1023 |
| 28184 | 1023 |
| 28185 | 1023 |
| 28186 | 0 |
| 28187 | 0 |
| 28188 | 0 |
| 28189 | 0 |
| 28190 | 0 |
| 28191 | 0 |
| 28192 | 0 |
| 28193 | 0 |
| 28194 | 0 |
| 28195 | 0 |
| 28196 | 0 |
| 28197 | 0 |
| 28198 | 0 |
| 28199 | 1023 |
| 28200 | 1023 |
| 28201 | 1023 |
| 28202 | 1023 |
| 28203 | 1023 |
| 28204 | 1023 |
| 28205 | 1023 |
| 28206 | 1023 |
| 28207 | 1023 |
| 28208 | 1023 |
| 28209 | 1023 |
| 28210 | 1023 |
| 28211 | 1023 |
| 28212 | 1023 |
| 28213 | 1023 |
| 28214 | 1023 |
| 28215 | 1023 |
| 28216 | 1023 |
| 28217 | 1023 |
| 28218 | 1023 |
| 28219 | 1023 |
| 28220 | 1023 |
| 28221 | 1023 |
| 28222 | 1023 |
| 28223 | 1023 |
| 28224 | 1023 |
| 28225 | 1023 |
| 28226 | 1023 |
| 28227 | 1023 |
| 28228 | 1023 |
| 28229 | 1023 |
| 28230 | 1023 |
| 28231 | 1023 |
| 28232 | 1023 |
| 28233 | 1023 |
| 28234 | 1023 |
| 28235 | 1023 |
| 28236 | 1023 |
| 28237 | 0 |
| 28238 | 0 |
| 28239 | 0 |
| 28240 | 0 |
| 28241 | 0 |
| 28242 | 0 |
| 28243 | 1 |
| 28244 | 0 |
| 28245 | 0 |
| 28246 | 0 |
| 28247 | 0 |
| 28248 | 0 |
| 28249 | 0 |
| 28250 | 1023 |
| 28251 | 1023 |
| 28252 | 1023 |
| 28253 | 1023 |
| 28254 | 1023 |
| 28255 | 1023 |
| 28256 | 1023 |
| 28257 | 1023 |
| 28258 | 1023 |
| 28259 | 1023 |
| 28260 | 1023 |
| 28261 | 1023 |
| 28262 | 1023 |
| 28263 | 1023 |
| 28264 | 1023 |
| 28265 | 1023 |
| 28266 | 1023 |
| 28267 | 1023 |
| 28268 | 1023 |
| 28269 | 1023 |
| 28270 | 1023 |
| 28271 | 1023 |
| 28272 | 1023 |
| 28273 | 1023 |
| 28274 | 1023 |
| 28275 | 1023 |
| 28276 | 1023 |
| 28277 | 1023 |
| 28278 | 1023 |
| 28279 | 1023 |
| 28280 | 1023 |
| 28281 | 1023 |
| 28282 | 1023 |
| 28283 | 1023 |
| 28284 | 1023 |
| 28285 | 1023 |
| 28286 | 1023 |
| 28287 | 1023 |
| 28288 | 0 |
| 28289 | 0 |
| 28290 | 0 |
| 28291 | 0 |
| 28292 | 0 |
| 28293 | 0 |
| 28294 | 0 |
| 28295 | 0 |
| 28296 | 0 |
| 28297 | 0 |
| 28298 | 0 |
| 28299 | 0 |
| 28300 | 0 |
| 28301 | 1023 |
| 28302 | 1023 |
| 28303 | 1023 |
| 28304 | 1023 |
| 28305 | 1023 |
| 28306 | 1023 |
| 28307 | 1023 |
| 28308 | 1023 |
| 28309 | 1023 |
| 28310 | 1023 |
| 28311 | 1023 |
| 28312 | 1023 |
| 28313 | 1023 |
| 28314 | 1023 |
| 28315 | 1023 |
| 28316 | 1023 |
| 28317 | 1023 |
| 28318 | 1023 |
| 28319 | 1023 |
| 28320 | 1023 |
| 28321 | 1023 |
| 28322 | 1023 |
| 28323 | 1023 |
| 28324 | 1023 |
| 28325 | 1023 |
| 28326 | 1023 |
| 28327 | 1023 |
| 28328 | 1023 |
| 28329 | 1023 |
| 28330 | 1023 |
| 28331 | 1023 |
| 28332 | 1023 |
| 28333 | 1023 |
| 28334 | 1023 |
| 28335 | 1023 |
| 28336 | 1023 |
| 28337 | 1023 |
| 28338 | 1023 |
| 28339 | 0 |
| 28340 | 0 |
| 28341 | 0 |
| 28342 | 0 |
| 28343 | 0 |
| 28344 | 0 |
| 28345 | 0 |
| 28346 | 0 |
| 28347 | 0 |
| 28348 | 0 |
| 28349 | 0 |
| 28350 | 0 |
| 28351 | 0 |
| 28352 | 0 |
| 28353 | 1023 |
| 28354 | 1023 |
| 28355 | 1023 |
| 28356 | 1023 |
| 28357 | 1023 |
| 28358 | 1023 |
| 28359 | 1023 |
| 28360 | 1023 |
| 28361 | 1023 |
| 28362 | 1023 |
| 28363 | 1023 |
| 28364 | 1023 |
| 28365 | 1023 |
| 28366 | 1023 |
| 28367 | 1023 |
| 28368 | 1023 |
| 28369 | 1023 |
| 28370 | 1023 |
| 28371 | 1023 |
| 28372 | 1023 |
| 28373 | 1023 |
| 28374 | 1023 |
| 28375 | 1023 |
| 28376 | 1023 |
| 28377 | 1023 |
| 28378 | 1023 |
| 28379 | 1023 |
| 28380 | 1023 |
| 28381 | 1023 |
| 28382 | 1023 |
| 28383 | 1023 |
| 28384 | 1023 |
| 28385 | 1023 |
| 28386 | 1023 |
| 28387 | 1023 |
| 28388 | 1023 |
| 28389 | 1023 |
| 28390 | 0 |
| 28391 | 0 |
| 28392 | 0 |
| 28393 | 0 |
| 28394 | 0 |
| 28395 | 0 |
| 28396 | 0 |
| 28397 | 0 |
| 28398 | 0 |
| 28399 | 0 |
| 28400 | 0 |
| 28401 | 0 |
| 28402 | 0 |
| 28403 | 0 |
| 28404 | 1023 |
| 28405 | 1023 |
| 28406 | 1023 |
| 28407 | 1023 |
| 28408 | 1023 |
| 28409 | 1023 |
| 28410 | 1023 |
| 28411 | 1023 |
| 28412 | 1023 |
| 28413 | 1023 |
| 28414 | 1023 |
| 28415 | 1023 |
| 28416 | 1023 |
| 28417 | 1023 |
| 28418 | 1023 |
| 28419 | 1023 |
| 28420 | 1023 |
| 28421 | 1023 |
| 28422 | 1023 |
| 28423 | 1023 |
| 28424 | 1023 |
| 28425 | 1023 |
| 28426 | 1023 |
| 28427 | 1023 |
| 28428 | 1023 |
| 28429 | 1023 |
| 28430 | 1023 |
| 28431 | 1023 |
| 28432 | 1023 |
| 28433 | 1023 |
| 28434 | 1023 |
| 28435 | 1023 |
| 28436 | 1023 |
| 28437 | 1023 |
| 28438 | 1023 |
| 28439 | 1023 |
| 28440 | 1023 |
| 28441 | 1023 |
| 28442 | 0 |
| 28443 | 0 |
| 28444 | 0 |
| 28445 | 0 |
| 28446 | 0 |
| 28447 | 0 |
| 28448 | 0 |
| 28449 | 0 |
| 28450 | 0 |
| 28451 | 0 |
| 28452 | 0 |
| 28453 | 0 |
| 28454 | 0 |
| 28455 | 0 |
| 28456 | 1023 |
| 28457 | 1023 |
| 28458 | 1023 |
| 28459 | 1023 |
| 28460 | 1023 |
| 28461 | 1023 |
| 28462 | 1023 |
| 28463 | 1023 |
| 28464 | 1023 |
| 28465 | 1023 |
| 28466 | 1023 |
| 28467 | 1023 |
| 28468 | 1023 |
| 28469 | 1023 |
| 28470 | 1023 |
| 28471 | 1023 |
| 28472 | 1023 |
| 28473 | 1023 |
| 28474 | 1023 |
| 28475 | 1023 |
| 28476 | 1023 |
| 28477 | 1023 |
| 28478 | 1023 |
| 28479 | 1023 |
| 28480 | 1023 |
| 28481 | 1023 |
| 28482 | 1023 |
| 28483 | 1023 |
| 28484 | 1023 |
| 28485 | 1023 |
| 28486 | 1023 |
| 28487 | 1023 |
| 28488 | 1023 |
| 28489 | 1023 |
| 28490 | 1023 |
| 28491 | 1023 |
| 28492 | 1023 |
| 28493 | 0 |
| 28494 | 0 |
| 28495 | 0 |
| 28496 | 0 |
| 28497 | 0 |
| 28498 | 0 |
| 28499 | 0 |
| 28500 | 0 |
| 28501 | 0 |
| 28502 | 0 |
| 28503 | 0 |
| 28504 | 0 |
| 28505 | 0 |
| 28506 | 0 |
| 28507 | 0 |
| 28508 | 1023 |
| 28509 | 1023 |
| 28510 | 1023 |
| 28511 | 1023 |
| 28512 | 1023 |
| 28513 | 1023 |
| 28514 | 1023 |
| 28515 | 1023 |
| 28516 | 1023 |
| 28517 | 1023 |
| 28518 | 1023 |
| 28519 | 1023 |
| 28520 | 1023 |
| 28521 | 1023 |
| 28522 | 1023 |
| 28523 | 1023 |
| 28524 | 1023 |
| 28525 | 1023 |
| 28526 | 1023 |
| 28527 | 1023 |
| 28528 | 1023 |
| 28529 | 1023 |
| 28530 | 1023 |
| 28531 | 1023 |
| 28532 | 1023 |
| 28533 | 1023 |
| 28534 | 1023 |
| 28535 | 1023 |
| 28536 | 1023 |
| 28537 | 1023 |
| 28538 | 1023 |
| 28539 | 1023 |
| 28540 | 1023 |
| 28541 | 1023 |
| 28542 | 1023 |
| 28543 | 1023 |
| 28544 | 1023 |
| 28545 | 0 |
| 28546 | 0 |
| 28547 | 0 |
| 28548 | 0 |
| 28549 | 0 |
| 28550 | 0 |
| 28551 | 0 |
| 28552 | 0 |
| 28553 | 0 |
| 28554 | 0 |
| 28555 | 0 |
| 28556 | 0 |
| 28557 | 0 |
| 28558 | 0 |
| 28559 | 1023 |
| 28560 | 1023 |
| 28561 | 1023 |
| 28562 | 1023 |
| 28563 | 1023 |
| 28564 | 1023 |
| 28565 | 1023 |
| 28566 | 1023 |
| 28567 | 1023 |
| 28568 | 1023 |
| 28569 | 1023 |
| 28570 | 1023 |
| 28571 | 1023 |
| 28572 | 1023 |
| 28573 | 1023 |
| 28574 | 1023 |
| 28575 | 1023 |
| 28576 | 1023 |
| 28577 | 1023 |
| 28578 | 1023 |
| 28579 | 1023 |
| 28580 | 1023 |
| 28581 | 1023 |
| 28582 | 1023 |
| 28583 | 1023 |
| 28584 | 1023 |
| 28585 | 1023 |
| 28586 | 1023 |
| 28587 | 1023 |
| 28588 | 1023 |
| 28589 | 1023 |
| 28590 | 1023 |
| 28591 | 1023 |
| 28592 | 1023 |
| 28593 | 1023 |
| 28594 | 1023 |
| 28595 | 1023 |
| 28596 | 1023 |
| 28597 | 0 |
| 28598 | 0 |
| 28599 | 0 |
| 28600 | 0 |
| 28601 | 0 |
| 28602 | 0 |
| 28603 | 0 |
| 28604 | 0 |
| 28605 | 0 |
| 28606 | 0 |
| 28607 | 0 |
| 28608 | 0 |
| 28609 | 0 |
| 28610 | 0 |
| 28611 | 1023 |
| 28612 | 1023 |
| 28613 | 1023 |
| 28614 | 1023 |
| 28615 | 1023 |
| 28616 | 1023 |
| 28617 | 1023 |
| 28618 | 1023 |
| 28619 | 1023 |
| 28620 | 1023 |
| 28621 | 1023 |
| 28622 | 1023 |
| 28623 | 1023 |
| 28624 | 1023 |
| 28625 | 1023 |
| 28626 | 1023 |
| 28627 | 1023 |
| 28628 | 1023 |
| 28629 | 1023 |
| 28630 | 1023 |
| 28631 | 1023 |
| 28632 | 1023 |
| 28633 | 1023 |
| 28634 | 1023 |
| 28635 | 1023 |
| 28636 | 1023 |
| 28637 | 1023 |
| 28638 | 1023 |
| 28639 | 1023 |
| 28640 | 1023 |
| 28641 | 1023 |
| 28642 | 1023 |
| 28643 | 1023 |
| 28644 | 1023 |
| 28645 | 1023 |
| 28646 | 1023 |
| 28647 | 1023 |
| 28648 | 0 |
| 28649 | 0 |
| 28650 | 0 |
| 28651 | 0 |
| 28652 | 1 |
| 28653 | 1 |
| 28654 | 0 |
| 28655 | 0 |
| 28656 | 0 |
| 28657 | 0 |
| 28658 | 0 |
| 28659 | 0 |
| 28660 | 0 |
| 28661 | 0 |
| 28662 | 0 |
| 28663 | 1023 |
| 28664 | 1023 |
| 28665 | 1023 |
| 28666 | 1023 |
| 28667 | 1023 |
| 28668 | 1023 |
| 28669 | 1023 |
| 28670 | 1023 |
| 28671 | 1023 |
| 28672 | 1023 |
| 28673 | 1023 |
| 28674 | 1023 |
| 28675 | 1023 |
| 28676 | 1023 |
| 28677 | 1023 |
| 28678 | 1023 |
| 28679 | 1023 |
| 28680 | 1023 |
| 28681 | 1023 |
| 28682 | 1023 |
| 28683 | 1023 |
| 28684 | 1023 |
| 28685 | 1023 |
| 28686 | 1023 |
| 28687 | 1023 |
| 28688 | 1023 |
| 28689 | 1023 |
| 28690 | 1023 |
| 28691 | 1023 |
| 28692 | 1023 |
| 28693 | 1023 |
| 28694 | 1023 |
| 28695 | 1023 |
| 28696 | 1023 |
| 28697 | 1023 |
| 28698 | 1023 |
| 28699 | 1023 |
| 28700 | 1023 |
| 28701 | 0 |
| 28702 | 0 |
| 28703 | 0 |
| 28704 | 0 |
| 28705 | 0 |
| 28706 | 0 |
| 28707 | 0 |
| 28708 | 0 |
| 28709 | 0 |
| 28710 | 0 |
| 28711 | 0 |
| 28712 | 0 |
| 28713 | 0 |
| 28714 | 1023 |
| 28715 | 1023 |
| 28716 | 1023 |
| 28717 | 1023 |
| 28718 | 1023 |
| 28719 | 1023 |
| 28720 | 1023 |
| 28721 | 1023 |
| 28722 | 1023 |
| 28723 | 1023 |
| 28724 | 1023 |
| 28725 | 1023 |
| 28726 | 1023 |
| 28727 | 1023 |
| 28728 | 1023 |
| 28729 | 1023 |
| 28730 | 1023 |
| 28731 | 1023 |
| 28732 | 1023 |
| 28733 | 1023 |
| 28734 | 1023 |
| 28735 | 1023 |
| 28736 | 1023 |
| 28737 | 1023 |
| 28738 | 1023 |
| 28739 | 1023 |
| 28740 | 1023 |
| 28741 | 1023 |
| 28742 | 1023 |
| 28743 | 1023 |
| 28744 | 1023 |
| 28745 | 1023 |
| 28746 | 1023 |
| 28747 | 1023 |
| 28748 | 1023 |
| 28749 | 1023 |
| 28750 | 1023 |
| 28751 | 1023 |
| 28752 | 0 |
| 28753 | 0 |
| 28754 | 0 |
| 28755 | 0 |
| 28756 | 0 |
| 28757 | 0 |
| 28758 | 0 |
| 28759 | 0 |
| 28760 | 0 |
| 28761 | 0 |
| 28762 | 0 |
| 28763 | 0 |
| 28764 | 0 |
| 28765 | 1023 |
| 28766 | 1023 |
| 28767 | 1023 |
| 28768 | 1023 |
| 28769 | 1023 |
| 28770 | 1023 |
| 28771 | 1023 |
| 28772 | 1023 |
| 28773 | 1023 |
| 28774 | 1023 |
| 28775 | 1023 |
| 28776 | 1023 |
| 28777 | 1023 |
| 28778 | 1023 |
| 28779 | 1023 |
| 28780 | 1023 |
| 28781 | 1023 |
| 28782 | 1023 |
| 28783 | 1023 |
| 28784 | 1023 |
| 28785 | 1023 |
| 28786 | 1023 |
| 28787 | 1023 |
| 28788 | 1023 |
| 28789 | 1023 |
| 28790 | 1023 |
| 28791 | 1023 |
| 28792 | 1023 |
| 28793 | 1023 |
| 28794 | 1023 |
| 28795 | 1023 |
| 28796 | 1023 |
| 28797 | 1023 |
| 28798 | 1023 |
| 28799 | 1023 |
| 28800 | 1023 |
| 28801 | 1023 |
| 28802 | 1023 |
| 28803 | 0 |
| 28804 | 0 |
| 28805 | 0 |
| 28806 | 0 |
| 28807 | 0 |
| 28808 | 0 |
| 28809 | 0 |
| 28810 | 0 |
| 28811 | 0 |
| 28812 | 0 |
| 28813 | 0 |
| 28814 | 0 |
| 28815 | 0 |
| 28816 | 1023 |
| 28817 | 1023 |
| 28818 | 1023 |
| 28819 | 1023 |
| 28820 | 1023 |
| 28821 | 1023 |
| 28822 | 1023 |
| 28823 | 1023 |
| 28824 | 1023 |
| 28825 | 1023 |
| 28826 | 1023 |
| 28827 | 1023 |
| 28828 | 1023 |
| 28829 | 1023 |
| 28830 | 1023 |
| 28831 | 1023 |
| 28832 | 1023 |
| 28833 | 1023 |
| 28834 | 1023 |
| 28835 | 1023 |
| 28836 | 1023 |
| 28837 | 1023 |
| 28838 | 1023 |
| 28839 | 1023 |
| 28840 | 1023 |
| 28841 | 1023 |
| 28842 | 1023 |
| 28843 | 1023 |
| 28844 | 1023 |
| 28845 | 1023 |
| 28846 | 1023 |
| 28847 | 1023 |
| 28848 | 1023 |
| 28849 | 1023 |
| 28850 | 1023 |
| 28851 | 1023 |
| 28852 | 1023 |
| 28853 | 1023 |
| 28854 | 0 |
| 28855 | 0 |
| 28856 | 0 |
| 28857 | 0 |
| 28858 | 0 |
| 28859 | 0 |
| 28860 | 0 |
| 28861 | 0 |
| 28862 | 0 |
| 28863 | 0 |
| 28864 | 0 |
| 28865 | 0 |
| 28866 | 0 |
| 28867 | 1023 |
| 28868 | 1023 |
| 28869 | 1023 |
| 28870 | 1023 |
| 28871 | 1023 |
| 28872 | 1023 |
| 28873 | 1023 |
| 28874 | 1023 |
| 28875 | 1023 |
| 28876 | 1023 |
| 28877 | 1023 |
| 28878 | 1023 |
| 28879 | 1023 |
| 28880 | 1023 |
| 28881 | 1023 |
| 28882 | 1023 |
| 28883 | 1023 |
| 28884 | 1023 |
| 28885 | 1023 |
| 28886 | 1023 |
| 28887 | 1023 |
| 28888 | 1023 |
| 28889 | 1023 |
| 28890 | 1023 |
| 28891 | 1023 |
| 28892 | 1023 |
| 28893 | 1023 |
| 28894 | 1023 |
| 28895 | 1023 |
| 28896 | 1023 |
| 28897 | 1023 |
| 28898 | 1023 |
| 28899 | 1023 |
| 28900 | 1023 |
| 28901 | 1023 |
| 28902 | 1023 |
| 28903 | 1023 |
| 28904 | 1023 |
| 28905 | 0 |
| 28906 | 0 |
| 28907 | 0 |
| 28908 | 0 |
| 28909 | 0 |
| 28910 | 0 |
| 28911 | 0 |
| 28912 | 0 |
| 28913 | 0 |
| 28914 | 0 |
| 28915 | 0 |
| 28916 | 0 |
| 28917 | 0 |
| 28918 | 1023 |
| 28919 | 1023 |
| 28920 | 1023 |
| 28921 | 1023 |
| 28922 | 1023 |
| 28923 | 1023 |
| 28924 | 1023 |
| 28925 | 1023 |
| 28926 | 1023 |
| 28927 | 1023 |
| 28928 | 1023 |
| 28929 | 1023 |
| 28930 | 1023 |
| 28931 | 1023 |
| 28932 | 1023 |
| 28933 | 1023 |
| 28934 | 1023 |
| 28935 | 1023 |
| 28936 | 1023 |
| 28937 | 1023 |
| 28938 | 1023 |
| 28939 | 1023 |
| 28940 | 1023 |
| 28941 | 1023 |
| 28942 | 1023 |
| 28943 | 1023 |
| 28944 | 1023 |
| 28945 | 1023 |
| 28946 | 1023 |
| 28947 | 1023 |
| 28948 | 1023 |
| 28949 | 1023 |
| 28950 | 1023 |
| 28951 | 1023 |
| 28952 | 1023 |
| 28953 | 1023 |
| 28954 | 1023 |
| 28955 | 1023 |
| 28956 | 0 |
| 28957 | 0 |
| 28958 | 0 |
| 28959 | 0 |
| 28960 | 0 |
| 28961 | 0 |
| 28962 | 0 |
| 28963 | 0 |
| 28964 | 0 |
| 28965 | 0 |
| 28966 | 0 |
| 28967 | 0 |
| 28968 | 0 |
| 28969 | 1023 |
| 28970 | 1023 |
| 28971 | 1023 |
| 28972 | 1023 |
| 28973 | 1023 |
| 28974 | 1023 |
| 28975 | 1023 |
| 28976 | 1023 |
| 28977 | 1023 |
| 28978 | 1023 |
| 28979 | 1023 |
| 28980 | 1023 |
| 28981 | 1023 |
| 28982 | 1023 |
| 28983 | 1023 |
| 28984 | 1023 |
| 28985 | 1023 |
| 28986 | 1023 |
| 28987 | 1023 |
| 28988 | 1023 |
| 28989 | 1023 |
| 28990 | 1023 |
| 28991 | 1023 |
| 28992 | 1023 |
| 28993 | 1023 |
| 28994 | 1023 |
| 28995 | 1023 |
| 28996 | 1023 |
| 28997 | 1023 |
| 28998 | 1023 |
| 28999 | 1023 |
| 29000 | 1023 |
| 29001 | 1023 |
| 29002 | 1023 |
| 29003 | 1023 |
| 29004 | 1023 |
| 29005 | 1023 |
| 29006 | 1023 |
| 29007 | 0 |
| 29008 | 0 |
| 29009 | 0 |
| 29010 | 0 |
| 29011 | 0 |
| 29012 | 0 |
| 29013 | 0 |
| 29014 | 0 |
| 29015 | 0 |
| 29016 | 0 |
| 29017 | 0 |
| 29018 | 0 |
| 29019 | 0 |
| 29020 | 0 |
| 29021 | 1023 |
| 29022 | 1023 |
| 29023 | 1023 |
| 29024 | 1023 |
| 29025 | 1023 |
| 29026 | 1023 |
| 29027 | 1023 |
| 29028 | 1023 |
| 29029 | 1023 |
| 29030 | 1023 |
| 29031 | 1023 |
| 29032 | 1023 |
| 29033 | 1023 |
| 29034 | 1023 |
| 29035 | 1023 |
| 29036 | 1023 |
| 29037 | 1023 |
| 29038 | 1023 |
| 29039 | 1023 |
| 29040 | 1023 |
| 29041 | 1023 |
| 29042 | 1023 |
| 29043 | 1023 |
| 29044 | 1023 |
| 29045 | 1023 |
| 29046 | 1023 |
| 29047 | 1023 |
| 29048 | 1023 |
| 29049 | 1023 |
| 29050 | 1023 |
| 29051 | 1023 |
| 29052 | 1023 |
| 29053 | 1023 |
| 29054 | 1023 |
| 29055 | 1023 |
| 29056 | 1023 |
| 29057 | 1023 |
| 29058 | 0 |
| 29059 | 0 |
| 29060 | 0 |
| 29061 | 0 |
| 29062 | 0 |
| 29063 | 0 |
| 29064 | 1 |
| 29065 | 0 |
| 29066 | 0 |
| 29067 | 0 |
| 29068 | 0 |
| 29069 | 0 |
| 29070 | 0 |
| 29071 | 0 |
| 29072 | 1023 |
| 29073 | 1023 |
| 29074 | 1023 |
| 29075 | 1023 |
| 29076 | 1023 |
| 29077 | 1023 |
| 29078 | 1023 |
| 29079 | 1023 |
| 29080 | 1023 |
| 29081 | 1023 |
| 29082 | 1023 |
| 29083 | 1023 |
| 29084 | 1023 |
| 29085 | 1023 |
| 29086 | 1023 |
| 29087 | 1023 |
| 29088 | 1023 |
| 29089 | 1023 |
| 29090 | 1023 |
| 29091 | 1023 |
| 29092 | 1023 |
| 29093 | 1023 |
| 29094 | 1023 |
| 29095 | 1023 |
| 29096 | 1023 |
| 29097 | 1023 |
| 29098 | 1023 |
| 29099 | 1023 |
| 29100 | 1023 |
| 29101 | 1023 |
| 29102 | 1023 |
| 29103 | 1023 |
| 29104 | 1023 |
| 29105 | 1023 |
| 29106 | 1023 |
| 29107 | 1023 |
| 29108 | 1023 |
| 29109 | 1023 |
| 29110 | 0 |
| 29111 | 0 |
| 29112 | 0 |
| 29113 | 0 |
| 29114 | 0 |
| 29115 | 0 |
| 29116 | 0 |
| 29117 | 0 |
| 29118 | 0 |
| 29119 | 0 |
| 29120 | 0 |
| 29121 | 0 |
| 29122 | 0 |
| 29123 | 0 |
| 29124 | 1023 |
| 29125 | 1023 |
| 29126 | 1023 |
| 29127 | 1023 |
| 29128 | 1023 |
| 29129 | 1023 |
| 29130 | 1023 |
| 29131 | 1023 |
| 29132 | 1023 |
| 29133 | 1023 |
| 29134 | 1023 |
| 29135 | 1023 |
| 29136 | 1023 |
| 29137 | 1023 |
| 29138 | 1023 |
| 29139 | 1023 |
| 29140 | 1023 |
| 29141 | 1023 |
| 29142 | 1023 |
| 29143 | 1023 |
| 29144 | 1023 |
| 29145 | 1023 |
| 29146 | 1023 |
| 29147 | 1023 |
| 29148 | 1023 |
| 29149 | 1023 |
| 29150 | 1023 |
| 29151 | 1023 |
| 29152 | 1023 |
| 29153 | 1023 |
| 29154 | 1023 |
| 29155 | 1023 |
| 29156 | 1023 |
| 29157 | 1023 |
| 29158 | 1023 |
| 29159 | 1023 |
| 29160 | 1023 |
| 29161 | 0 |
| 29162 | 0 |
| 29163 | 0 |
| 29164 | 0 |
| 29165 | 0 |
| 29166 | 0 |
| 29167 | 0 |
| 29168 | 0 |
| 29169 | 0 |
| 29170 | 0 |
| 29171 | 0 |
| 29172 | 0 |
| 29173 | 0 |
| 29174 | 0 |
| 29175 | 0 |
| 29176 | 1023 |
| 29177 | 1023 |
| 29178 | 1023 |
| 29179 | 1023 |
| 29180 | 1023 |
| 29181 | 1023 |
| 29182 | 1023 |
| 29183 | 1023 |
| 29184 | 1023 |
| 29185 | 1023 |
| 29186 | 1023 |
| 29187 | 1023 |
| 29188 | 1023 |
| 29189 | 1023 |
| 29190 | 1023 |
| 29191 | 1023 |
| 29192 | 1023 |
| 29193 | 1023 |
| 29194 | 1023 |
| 29195 | 1023 |
| 29196 | 1023 |
| 29197 | 1023 |
| 29198 | 1023 |
| 29199 | 1023 |
| 29200 | 1023 |
| 29201 | 1023 |
| 29202 | 1023 |
| 29203 | 1023 |
| 29204 | 1023 |
| 29205 | 1023 |
| 29206 | 1023 |
| 29207 | 1023 |
| 29208 | 1023 |
| 29209 | 1023 |
| 29210 | 1023 |
| 29211 | 1023 |
| 29212 | 1023 |
| 29213 | 0 |
| 29214 | 0 |
| 29215 | 0 |
| 29216 | 0 |
| 29217 | 0 |
| 29218 | 0 |
| 29219 | 1 |
| 29220 | 0 |
| 29221 | 0 |
| 29222 | 0 |
| 29223 | 0 |
| 29224 | 0 |
| 29225 | 0 |
| 29226 | 0 |
| 29227 | 0 |
| 29228 | 1023 |
| 29229 | 1023 |
| 29230 | 1023 |
| 29231 | 1023 |
| 29232 | 1023 |
| 29233 | 1023 |
| 29234 | 1023 |
| 29235 | 1023 |
| 29236 | 1023 |
| 29237 | 1023 |
| 29238 | 1023 |
| 29239 | 1023 |
| 29240 | 1023 |
| 29241 | 1023 |
| 29242 | 1023 |
| 29243 | 1023 |
| 29244 | 1023 |
| 29245 | 1023 |
| 29246 | 1023 |
| 29247 | 1023 |
| 29248 | 1023 |
| 29249 | 1023 |
| 29250 | 1023 |
| 29251 | 1023 |
| 29252 | 1023 |
| 29253 | 1023 |
| 29254 | 1023 |
| 29255 | 1023 |
| 29256 | 1023 |
| 29257 | 1023 |
| 29258 | 1023 |
| 29259 | 1023 |
| 29260 | 1023 |
| 29261 | 1023 |
| 29262 | 1023 |
| 29263 | 1023 |
| 29264 | 1023 |
| 29265 | 1023 |
| 29266 | 0 |
| 29267 | 0 |
| 29268 | 0 |
| 29269 | 0 |
| 29270 | 0 |
| 29271 | 0 |
| 29272 | 0 |
| 29273 | 0 |
| 29274 | 0 |
| 29275 | 0 |
| 29276 | 0 |
| 29277 | 0 |
| 29278 | 0 |
| 29279 | 1023 |
| 29280 | 1023 |
| 29281 | 1023 |
| 29282 | 1023 |
| 29283 | 1023 |
| 29284 | 1023 |
| 29285 | 1023 |
| 29286 | 1023 |
| 29287 | 1023 |
| 29288 | 1023 |
| 29289 | 1023 |
| 29290 | 1023 |
| 29291 | 1023 |
| 29292 | 1023 |
| 29293 | 1023 |
| 29294 | 1023 |
| 29295 | 1023 |
| 29296 | 1023 |
| 29297 | 1023 |
| 29298 | 1023 |
| 29299 | 1023 |
| 29300 | 1023 |
| 29301 | 1023 |
| 29302 | 1023 |
| 29303 | 1023 |
| 29304 | 1023 |
| 29305 | 1023 |
| 29306 | 1023 |
| 29307 | 1023 |
| 29308 | 1023 |
| 29309 | 1023 |
| 29310 | 1023 |
| 29311 | 1023 |
| 29312 | 1023 |
| 29313 | 1023 |
| 29314 | 1023 |
| 29315 | 1023 |
| 29316 | 1023 |
| 29317 | 0 |
| 29318 | 0 |
| 29319 | 0 |
| 29320 | 0 |
| 29321 | 0 |
| 29322 | 0 |
| 29323 | 0 |
| 29324 | 0 |
| 29325 | 0 |
| 29326 | 0 |
| 29327 | 0 |
| 29328 | 0 |
| 29329 | 0 |
| 29330 | 1023 |
| 29331 | 1023 |
| 29332 | 1023 |
| 29333 | 1023 |
| 29334 | 1023 |
| 29335 | 1023 |
| 29336 | 1023 |
| 29337 | 1023 |
| 29338 | 1023 |
| 29339 | 1023 |
| 29340 | 1023 |
| 29341 | 1023 |
| 29342 | 1023 |
| 29343 | 1023 |
| 29344 | 1023 |
| 29345 | 1023 |
| 29346 | 1023 |
| 29347 | 1023 |
| 29348 | 1023 |
| 29349 | 1023 |
| 29350 | 1023 |
| 29351 | 1023 |
| 29352 | 1023 |
| 29353 | 1023 |
| 29354 | 1023 |
| 29355 | 1023 |
| 29356 | 1023 |
| 29357 | 1023 |
| 29358 | 1023 |
| 29359 | 1023 |
| 29360 | 1023 |
| 29361 | 1023 |
| 29362 | 1023 |
| 29363 | 1023 |
| 29364 | 1023 |
| 29365 | 1023 |
| 29366 | 1023 |
| 29367 | 1023 |
| 29368 | 0 |
| 29369 | 0 |
| 29370 | 0 |
| 29371 | 0 |
| 29372 | 0 |
| 29373 | 0 |
| 29374 | 0 |
| 29375 | 0 |
| 29376 | 0 |
| 29377 | 0 |
| 29378 | 0 |
| 29379 | 0 |
| 29380 | 0 |
| 29381 | 1023 |
| 29382 | 1023 |
| 29383 | 1023 |
| 29384 | 1023 |
| 29385 | 1023 |
| 29386 | 1023 |
| 29387 | 1023 |
| 29388 | 1023 |
| 29389 | 1023 |
| 29390 | 1023 |
| 29391 | 1023 |
| 29392 | 1023 |
| 29393 | 1023 |
| 29394 | 1023 |
| 29395 | 1023 |
| 29396 | 1023 |
| 29397 | 1023 |
| 29398 | 1023 |
| 29399 | 1023 |
| 29400 | 1023 |
| 29401 | 1023 |
| 29402 | 1023 |
| 29403 | 1023 |
| 29404 | 1023 |
| 29405 | 1023 |
| 29406 | 1023 |
| 29407 | 1023 |
| 29408 | 1023 |
| 29409 | 1023 |
| 29410 | 1023 |
| 29411 | 1023 |
| 29412 | 1023 |
| 29413 | 1023 |
| 29414 | 1023 |
| 29415 | 1023 |
| 29416 | 1023 |
| 29417 | 1023 |
| 29418 | 1023 |
| 29419 | 0 |
| 29420 | 0 |
| 29421 | 0 |
| 29422 | 0 |
| 29423 | 0 |
| 29424 | 0 |
| 29425 | 0 |
| 29426 | 0 |
| 29427 | 0 |
| 29428 | 0 |
| 29429 | 0 |
| 29430 | 0 |
| 29431 | 0 |
| 29432 | 1023 |
| 29433 | 1023 |
| 29434 | 1023 |
| 29435 | 1023 |
| 29436 | 1023 |
| 29437 | 1023 |
| 29438 | 1023 |
| 29439 | 1023 |
| 29440 | 1023 |
| 29441 | 1023 |
| 29442 | 1023 |
| 29443 | 1023 |
| 29444 | 1023 |
| 29445 | 1023 |
| 29446 | 1023 |
| 29447 | 1023 |
| 29448 | 1023 |
| 29449 | 1023 |
| 29450 | 1023 |
| 29451 | 1023 |
| 29452 | 1023 |
| 29453 | 1023 |
| 29454 | 1023 |
| 29455 | 1023 |
| 29456 | 1023 |
| 29457 | 1023 |
| 29458 | 1023 |
| 29459 | 1023 |
| 29460 | 1023 |
| 29461 | 1023 |
| 29462 | 1023 |
| 29463 | 1023 |
| 29464 | 1023 |
| 29465 | 1023 |
| 29466 | 1023 |
| 29467 | 1023 |
| 29468 | 1023 |
| 29469 | 1023 |
| 29470 | 0 |
| 29471 | 0 |
| 29472 | 0 |
| 29473 | 0 |
| 29474 | 0 |
| 29475 | 0 |
| 29476 | 0 |
| 29477 | 0 |
| 29478 | 0 |
| 29479 | 0 |
| 29480 | 0 |
| 29481 | 0 |
| 29482 | 0 |
| 29483 | 1023 |
| 29484 | 1023 |
| 29485 | 1023 |
| 29486 | 1023 |
| 29487 | 1023 |
| 29488 | 1023 |
| 29489 | 1023 |
| 29490 | 1023 |
| 29491 | 1023 |
| 29492 | 1023 |
| 29493 | 1023 |
| 29494 | 1023 |
| 29495 | 1023 |
| 29496 | 1023 |
| 29497 | 1023 |
| 29498 | 1023 |
| 29499 | 1023 |
| 29500 | 1023 |
| 29501 | 1023 |
| 29502 | 1023 |
| 29503 | 1023 |
| 29504 | 1023 |
| 29505 | 1023 |
| 29506 | 1023 |
| 29507 | 1023 |
| 29508 | 1023 |
| 29509 | 1023 |
| 29510 | 1023 |
| 29511 | 1023 |
| 29512 | 1023 |
| 29513 | 1023 |
| 29514 | 1023 |
| 29515 | 1023 |
| 29516 | 1023 |
| 29517 | 1023 |
| 29518 | 1023 |
| 29519 | 1023 |
| 29520 | 1023 |
| 29521 | 0 |
| 29522 | 0 |
| 29523 | 0 |
| 29524 | 0 |
| 29525 | 0 |
| 29526 | 0 |
| 29527 | 0 |
| 29528 | 0 |
| 29529 | 0 |
| 29530 | 0 |
| 29531 | 0 |
| 29532 | 0 |
| 29533 | 0 |
| 29534 | 1023 |
| 29535 | 1023 |
| 29536 | 1023 |
| 29537 | 1023 |
| 29538 | 1023 |
| 29539 | 1023 |
| 29540 | 1023 |
| 29541 | 1023 |
| 29542 | 1023 |
| 29543 | 1023 |
| 29544 | 1023 |
| 29545 | 1023 |
| 29546 | 1023 |
| 29547 | 1023 |
| 29548 | 1023 |
| 29549 | 1023 |
| 29550 | 1023 |
| 29551 | 1023 |
| 29552 | 1023 |
| 29553 | 1023 |
| 29554 | 1023 |
| 29555 | 1023 |
| 29556 | 1023 |
| 29557 | 1023 |
| 29558 | 1023 |
| 29559 | 1023 |
| 29560 | 1023 |
| 29561 | 1023 |
| 29562 | 1023 |
| 29563 | 1023 |
| 29564 | 1023 |
| 29565 | 1023 |
| 29566 | 1023 |
| 29567 | 1023 |
| 29568 | 1023 |
| 29569 | 1023 |
| 29570 | 1023 |
| 29571 | 1023 |
| 29572 | 0 |
| 29573 | 0 |
| 29574 | 0 |
| 29575 | 0 |
| 29576 | 0 |
| 29577 | 0 |
| 29578 | 0 |
| 29579 | 0 |
| 29580 | 0 |
| 29581 | 0 |
| 29582 | 0 |
| 29583 | 0 |
| 29584 | 0 |
| 29585 | 1023 |
| 29586 | 1023 |
| 29587 | 1023 |
| 29588 | 1023 |
| 29589 | 1023 |
| 29590 | 1023 |
| 29591 | 1023 |
| 29592 | 1023 |
| 29593 | 1023 |
| 29594 | 1023 |
| 29595 | 1023 |
| 29596 | 1023 |
| 29597 | 1023 |
| 29598 | 1023 |
| 29599 | 1023 |
| 29600 | 1023 |
| 29601 | 1023 |
| 29602 | 1023 |
| 29603 | 1023 |
| 29604 | 1023 |
| 29605 | 1023 |
| 29606 | 1023 |
| 29607 | 1023 |
| 29608 | 1023 |
| 29609 | 1023 |
| 29610 | 1023 |
| 29611 | 1023 |
| 29612 | 1023 |
| 29613 | 1023 |
| 29614 | 1023 |
| 29615 | 1023 |
| 29616 | 1023 |
| 29617 | 1023 |
| 29618 | 1023 |
| 29619 | 1023 |
| 29620 | 1023 |
| 29621 | 1023 |
| 29622 | 1023 |
| 29623 | 0 |
| 29624 | 0 |
| 29625 | 0 |
| 29626 | 0 |
| 29627 | 0 |
| 29628 | 0 |
| 29629 | 0 |
| 29630 | 0 |
| 29631 | 0 |
| 29632 | 0 |
| 29633 | 0 |
| 29634 | 0 |
| 29635 | 0 |
| 29636 | 0 |
| 29637 | 1023 |
| 29638 | 1023 |
| 29639 | 1023 |
| 29640 | 1023 |
| 29641 | 1023 |
| 29642 | 1023 |
| 29643 | 1023 |
| 29644 | 1023 |
| 29645 | 1023 |
| 29646 | 1023 |
| 29647 | 1023 |
| 29648 | 1023 |
| 29649 | 1023 |
| 29650 | 1023 |
| 29651 | 1023 |
| 29652 | 1023 |
| 29653 | 1023 |
| 29654 | 1023 |
| 29655 | 1023 |
| 29656 | 1023 |
| 29657 | 1023 |
| 29658 | 1023 |
| 29659 | 1023 |
| 29660 | 1023 |
| 29661 | 1023 |
| 29662 | 1023 |
| 29663 | 1023 |
| 29664 | 1023 |
| 29665 | 1023 |
| 29666 | 1023 |
| 29667 | 1023 |
| 29668 | 1023 |
| 29669 | 1023 |
| 29670 | 1023 |
| 29671 | 1023 |
| 29672 | 1023 |
| 29673 | 1023 |
| 29674 | 0 |
| 29675 | 0 |
| 29676 | 0 |
| 29677 | 0 |
| 29678 | 0 |
| 29679 | 0 |
| 29680 | 0 |
| 29681 | 0 |
| 29682 | 0 |
| 29683 | 0 |
| 29684 | 0 |
| 29685 | 0 |
| 29686 | 0 |
| 29687 | 0 |
| 29688 | 1023 |
| 29689 | 1023 |
| 29690 | 1023 |
| 29691 | 1023 |
| 29692 | 1023 |
| 29693 | 1023 |
| 29694 | 1023 |
| 29695 | 1023 |
| 29696 | 1023 |
| 29697 | 1023 |
| 29698 | 1023 |
| 29699 | 1023 |
| 29700 | 1023 |
| 29701 | 1023 |
| 29702 | 1023 |
| 29703 | 1023 |
| 29704 | 1023 |
| 29705 | 1023 |
| 29706 | 1023 |
| 29707 | 1023 |
| 29708 | 1023 |
| 29709 | 1023 |
| 29710 | 1023 |
| 29711 | 1023 |
| 29712 | 1023 |
| 29713 | 1023 |
| 29714 | 1023 |
| 29715 | 1023 |
| 29716 | 1023 |
| 29717 | 1023 |
| 29718 | 1023 |
| 29719 | 1023 |
| 29720 | 1023 |
| 29721 | 1023 |
| 29722 | 1023 |
| 29723 | 1023 |
| 29724 | 1023 |
| 29725 | 1023 |
| 29726 | 0 |
| 29727 | 0 |
| 29728 | 0 |
| 29729 | 0 |
| 29730 | 0 |
| 29731 | 0 |
| 29732 | 0 |
| 29733 | 0 |
| 29734 | 0 |
| 29735 | 0 |
| 29736 | 0 |
| 29737 | 0 |
| 29738 | 0 |
| 29739 | 0 |
| 29740 | 1023 |
| 29741 | 1023 |
| 29742 | 1023 |
| 29743 | 1023 |
| 29744 | 1023 |
| 29745 | 1023 |
| 29746 | 1023 |
| 29747 | 1023 |
| 29748 | 1023 |
| 29749 | 1023 |
| 29750 | 1023 |
| 29751 | 1023 |
| 29752 | 1023 |
| 29753 | 1023 |
| 29754 | 1023 |
| 29755 | 1023 |
| 29756 | 1023 |
| 29757 | 1023 |
| 29758 | 1023 |
| 29759 | 1023 |
| 29760 | 1023 |
| 29761 | 1023 |
| 29762 | 1023 |
| 29763 | 1023 |
| 29764 | 1023 |
| 29765 | 1023 |
| 29766 | 1023 |
| 29767 | 1023 |
| 29768 | 1023 |
| 29769 | 1023 |
| 29770 | 1023 |
| 29771 | 1023 |
| 29772 | 1023 |
| 29773 | 1023 |
| 29774 | 1023 |
| 29775 | 1023 |
| 29776 | 1023 |
| 29777 | 0 |
| 29778 | 0 |
| 29779 | 0 |
| 29780 | 0 |
| 29781 | 0 |
| 29782 | 0 |
| 29783 | 0 |
| 29784 | 0 |
| 29785 | 0 |
| 29786 | 0 |
| 29787 | 0 |
| 29788 | 0 |
| 29789 | 0 |
| 29790 | 0 |
| 29791 | 0 |
| 29792 | 1023 |
| 29793 | 1023 |
| 29794 | 1023 |
| 29795 | 1023 |
| 29796 | 1023 |
| 29797 | 1023 |
| 29798 | 1023 |
| 29799 | 1023 |
| 29800 | 1023 |
| 29801 | 1023 |
| 29802 | 1023 |
| 29803 | 1023 |
| 29804 | 1023 |
| 29805 | 1023 |
| 29806 | 1023 |
| 29807 | 1023 |
| 29808 | 1023 |
| 29809 | 1023 |
| 29810 | 1023 |
| 29811 | 1023 |
| 29812 | 1023 |
| 29813 | 1023 |
| 29814 | 1023 |
| 29815 | 1023 |
| 29816 | 1023 |
| 29817 | 1023 |
| 29818 | 1023 |
| 29819 | 1023 |
| 29820 | 1023 |
| 29821 | 1023 |
| 29822 | 1023 |
| 29823 | 1023 |
| 29824 | 1023 |
| 29825 | 1023 |
| 29826 | 1023 |
| 29827 | 1023 |
| 29828 | 1023 |
| 29829 | 0 |
| 29830 | 0 |
| 29831 | 0 |
| 29832 | 0 |
| 29833 | 0 |
| 29834 | 0 |
| 29835 | 0 |
| 29836 | 0 |
| 29837 | 0 |
| 29838 | 0 |
| 29839 | 0 |
| 29840 | 0 |
| 29841 | 0 |
| 29842 | 0 |
| 29843 | 0 |
| 29844 | 1023 |
| 29845 | 1023 |
| 29846 | 1023 |
| 29847 | 1023 |
| 29848 | 1023 |
| 29849 | 1023 |
| 29850 | 1023 |
| 29851 | 1023 |
| 29852 | 1023 |
| 29853 | 1023 |
| 29854 | 1023 |
| 29855 | 1023 |
| 29856 | 1023 |
| 29857 | 1023 |
| 29858 | 1023 |
| 29859 | 1023 |
| 29860 | 1023 |
| 29861 | 1023 |
| 29862 | 1023 |
| 29863 | 1023 |
| 29864 | 1023 |
| 29865 | 1023 |
| 29866 | 1023 |
| 29867 | 1023 |
| 29868 | 1023 |
| 29869 | 1023 |
| 29870 | 1023 |
| 29871 | 1023 |
| 29872 | 1023 |
| 29873 | 1023 |
| 29874 | 1023 |
| 29875 | 1023 |
| 29876 | 1023 |
| 29877 | 1023 |
| 29878 | 1023 |
| 29879 | 1023 |
| 29880 | 1023 |
| 29881 | 163 |
| 29882 | 0 |
| 29883 | 0 |
| 29884 | 0 |
| 29885 | 0 |
| 29886 | 0 |
| 29887 | 0 |
| 29888 | 0 |
| 29889 | 0 |
| 29890 | 0 |
| 29891 | 0 |
| 29892 | 0 |
| 29893 | 0 |
| 29894 | 0 |
| 29895 | 1023 |
| 29896 | 1023 |
| 29897 | 1023 |
| 29898 | 1023 |
| 29899 | 1023 |
| 29900 | 1023 |
| 29901 | 1023 |
| 29902 | 1023 |
| 29903 | 1023 |
| 29904 | 1023 |
| 29905 | 1023 |
| 29906 | 1023 |
| 29907 | 1023 |
| 29908 | 1023 |
| 29909 | 1023 |
| 29910 | 1023 |
| 29911 | 1023 |
| 29912 | 1023 |
| 29913 | 1023 |
| 29914 | 1023 |
| 29915 | 1023 |
| 29916 | 1023 |
| 29917 | 1023 |
| 29918 | 1023 |
| 29919 | 1023 |
| 29920 | 1023 |
| 29921 | 1023 |
| 29922 | 1023 |
| 29923 | 1023 |
| 29924 | 1023 |
| 29925 | 1023 |
| 29926 | 1023 |
| 29927 | 1023 |
| 29928 | 1023 |
| 29929 | 1023 |
| 29930 | 1023 |
| 29931 | 1023 |
| 29932 | 1023 |
| 29933 | 0 |
| 29934 | 0 |
| 29935 | 0 |
| 29936 | 0 |
| 29937 | 0 |
| 29938 | 0 |
| 29939 | 0 |
| 29940 | 0 |
| 29941 | 0 |
| 29942 | 0 |
| 29943 | 0 |
| 29944 | 0 |
| 29945 | 0 |
| 29946 | 1023 |
| 29947 | 1023 |
| 29948 | 1023 |
| 29949 | 1023 |
| 29950 | 1023 |
| 29951 | 1023 |
| 29952 | 1023 |
| 29953 | 1023 |
| 29954 | 1023 |
| 29955 | 1023 |
| 29956 | 1023 |
| 29957 | 1023 |
| 29958 | 1023 |
| 29959 | 1023 |
| 29960 | 1023 |
| 29961 | 1023 |
| 29962 | 1023 |
| 29963 | 1023 |
| 29964 | 1023 |
| 29965 | 1023 |
| 29966 | 1023 |
| 29967 | 1023 |
| 29968 | 1023 |
| 29969 | 1023 |
| 29970 | 1023 |
| 29971 | 1023 |
| 29972 | 1023 |
| 29973 | 1023 |
| 29974 | 1023 |
| 29975 | 1023 |
| 29976 | 1023 |
| 29977 | 1023 |
| 29978 | 1023 |
| 29979 | 1023 |
| 29980 | 1023 |
| 29981 | 1023 |
| 29982 | 1023 |
| 29983 | 1023 |
| 29984 | 0 |
| 29985 | 0 |
| 29986 | 0 |
| 29987 | 0 |
| 29988 | 0 |
| 29989 | 0 |
| 29990 | 0 |
| 29991 | 0 |
| 29992 | 0 |
| 29993 | 0 |
| 29994 | 0 |
| 29995 | 0 |
| 29996 | 0 |
| 29997 | 0 |
| 29998 | 1023 |
| 29999 | 1023 |
| 30000 | 1023 |
| 30001 | 1023 |
| 30002 | 1023 |
| 30003 | 1023 |
| 30004 | 1023 |
| 30005 | 1023 |
| 30006 | 1023 |
| 30007 | 1023 |
| 30008 | 1023 |
| 30009 | 1023 |
| 30010 | 1023 |
| 30011 | 1023 |
| 30012 | 1023 |
| 30013 | 1023 |
| 30014 | 1023 |
| 30015 | 1023 |
| 30016 | 1023 |
| 30017 | 1023 |
| 30018 | 1023 |
| 30019 | 1023 |
| 30020 | 1023 |
| 30021 | 1023 |
| 30022 | 1023 |
| 30023 | 1023 |
| 30024 | 1023 |
| 30025 | 1023 |
| 30026 | 1023 |
| 30027 | 1023 |
| 30028 | 1023 |
| 30029 | 1023 |
| 30030 | 1023 |
| 30031 | 1023 |
| 30032 | 1023 |
| 30033 | 1023 |
| 30034 | 1023 |
| 30035 | 0 |
| 30036 | 0 |
| 30037 | 0 |
| 30038 | 0 |
| 30039 | 0 |
| 30040 | 0 |
| 30041 | 0 |
| 30042 | 0 |
| 30043 | 0 |
| 30044 | 0 |
| 30045 | 0 |
| 30046 | 0 |
| 30047 | 0 |
| 30048 | 0 |
| 30049 | 1023 |
| 30050 | 1023 |
| 30051 | 1023 |
| 30052 | 1023 |
| 30053 | 1023 |
| 30054 | 1023 |
| 30055 | 1023 |
| 30056 | 1023 |
| 30057 | 1023 |
| 30058 | 1023 |
| 30059 | 1023 |
| 30060 | 1023 |
| 30061 | 1023 |
| 30062 | 1023 |
| 30063 | 1023 |
| 30064 | 1023 |
| 30065 | 1023 |
| 30066 | 1023 |
| 30067 | 1023 |
| 30068 | 1023 |
| 30069 | 1023 |
| 30070 | 1023 |
| 30071 | 1023 |
| 30072 | 1023 |
| 30073 | 1023 |
| 30074 | 1023 |
| 30075 | 1023 |
| 30076 | 1023 |
| 30077 | 1023 |
| 30078 | 1023 |
| 30079 | 1023 |
| 30080 | 1023 |
| 30081 | 1023 |
| 30082 | 1023 |
| 30083 | 1023 |
| 30084 | 1023 |
| 30085 | 1023 |
| 30086 | 1023 |
| 30087 | 0 |
| 30088 | 0 |
| 30089 | 0 |
| 30090 | 0 |
| 30091 | 0 |
| 30092 | 0 |
| 30093 | 0 |
| 30094 | 0 |
| 30095 | 0 |
| 30096 | 0 |
| 30097 | 0 |
| 30098 | 0 |
| 30099 | 0 |
| 30100 | 0 |
| 30101 | 1023 |
| 30102 | 1023 |
| 30103 | 1023 |
| 30104 | 1023 |
| 30105 | 1023 |
| 30106 | 1023 |
| 30107 | 1023 |
| 30108 | 1023 |
| 30109 | 1023 |
| 30110 | 1023 |
| 30111 | 1023 |
| 30112 | 1023 |
| 30113 | 1023 |
| 30114 | 1023 |
| 30115 | 1023 |
| 30116 | 1023 |
| 30117 | 1023 |
| 30118 | 1023 |
| 30119 | 1023 |
| 30120 | 1023 |
| 30121 | 1023 |
| 30122 | 1023 |
| 30123 | 1023 |
| 30124 | 1023 |
| 30125 | 1023 |
| 30126 | 1023 |
| 30127 | 1023 |
| 30128 | 1023 |
| 30129 | 1023 |
| 30130 | 1023 |
| 30131 | 1023 |
| 30132 | 1023 |
| 30133 | 1023 |
| 30134 | 1023 |
| 30135 | 1023 |
| 30136 | 1023 |
| 30137 | 1023 |
| 30138 | 0 |
| 30139 | 0 |
| 30140 | 0 |
| 30141 | 0 |
| 30142 | 0 |
| 30143 | 0 |
| 30144 | 0 |
| 30145 | 0 |
| 30146 | 0 |
| 30147 | 0 |
| 30148 | 0 |
| 30149 | 0 |
| 30150 | 0 |
| 30151 | 0 |
| 30152 | 1023 |
| 30153 | 1023 |
| 30154 | 1023 |
| 30155 | 1023 |
| 30156 | 1023 |
| 30157 | 1023 |
| 30158 | 1023 |
| 30159 | 1023 |
| 30160 | 1023 |
| 30161 | 1023 |
| 30162 | 1023 |
| 30163 | 1023 |
| 30164 | 1023 |
| 30165 | 1023 |
| 30166 | 1023 |
| 30167 | 1023 |
| 30168 | 1023 |
| 30169 | 1023 |
| 30170 | 1023 |
| 30171 | 1023 |
| 30172 | 1023 |
| 30173 | 1023 |
| 30174 | 1023 |
| 30175 | 1023 |
| 30176 | 1023 |
| 30177 | 1023 |
| 30178 | 1023 |
| 30179 | 1023 |
| 30180 | 1023 |
| 30181 | 1023 |
| 30182 | 1023 |
| 30183 | 1023 |
| 30184 | 1023 |
| 30185 | 1023 |
| 30186 | 1023 |
| 30187 | 1023 |
| 30188 | 1023 |
| 30189 | 1023 |
| 30190 | 0 |
| 30191 | 0 |
| 30192 | 0 |
| 30193 | 0 |
| 30194 | 0 |
| 30195 | 0 |
| 30196 | 0 |
| 30197 | 0 |
| 30198 | 0 |
| 30199 | 0 |
| 30200 | 0 |
| 30201 | 0 |
| 30202 | 0 |
| 30203 | 0 |
| 30204 | 1023 |
| 30205 | 1023 |
| 30206 | 1023 |
| 30207 | 1023 |
| 30208 | 1023 |
| 30209 | 1023 |
| 30210 | 1023 |
| 30211 | 1023 |
| 30212 | 1023 |
| 30213 | 1023 |
| 30214 | 1023 |
| 30215 | 1023 |
| 30216 | 1023 |
| 30217 | 1023 |
| 30218 | 1023 |
| 30219 | 1023 |
| 30220 | 1023 |
| 30221 | 1023 |
| 30222 | 1023 |
| 30223 | 1023 |
| 30224 | 1023 |
| 30225 | 1023 |
| 30226 | 1023 |
| 30227 | 1023 |
| 30228 | 1023 |
| 30229 | 1023 |
| 30230 | 1023 |
| 30231 | 1023 |
| 30232 | 1023 |
| 30233 | 1023 |
| 30234 | 1023 |
| 30235 | 1023 |
| 30236 | 1023 |
| 30237 | 1023 |
| 30238 | 1023 |
| 30239 | 1023 |
| 30240 | 1023 |
| 30241 | 0 |
| 30242 | 0 |
| 30243 | 0 |
| 30244 | 0 |
| 30245 | 0 |
| 30246 | 0 |
| 30247 | 0 |
| 30248 | 0 |
| 30249 | 0 |
| 30250 | 0 |
| 30251 | 0 |
| 30252 | 0 |
| 30253 | 0 |
| 30254 | 0 |
| 30255 | 0 |
| 30256 | 1023 |
| 30257 | 1023 |
| 30258 | 1023 |
| 30259 | 1023 |
| 30260 | 1023 |
| 30261 | 1023 |
| 30262 | 1023 |
| 30263 | 1023 |
| 30264 | 1023 |
| 30265 | 1023 |
| 30266 | 1023 |
| 30267 | 1023 |
| 30268 | 1023 |
| 30269 | 1023 |
| 30270 | 1023 |
| 30271 | 1023 |
| 30272 | 1023 |
| 30273 | 1023 |
| 30274 | 1023 |
| 30275 | 1023 |
| 30276 | 1023 |
| 30277 | 1023 |
| 30278 | 1023 |
| 30279 | 1023 |
| 30280 | 1023 |
| 30281 | 1023 |
| 30282 | 1023 |
| 30283 | 1023 |
| 30284 | 1023 |
| 30285 | 1023 |
| 30286 | 1023 |
| 30287 | 1023 |
| 30288 | 1023 |
| 30289 | 1023 |
| 30290 | 1023 |
| 30291 | 1023 |
| 30292 | 1023 |
| 30293 | 0 |
| 30294 | 0 |
| 30295 | 0 |
| 30296 | 0 |
| 30297 | 0 |
| 30298 | 0 |
| 30299 | 0 |
| 30300 | 0 |
| 30301 | 0 |
| 30302 | 0 |
| 30303 | 0 |
| 30304 | 0 |
| 30305 | 0 |
| 30306 | 0 |
| 30307 | 0 |
| 30308 | 1023 |
| 30309 | 1023 |
| 30310 | 1023 |
| 30311 | 1023 |
| 30312 | 1023 |
| 30313 | 1023 |
| 30314 | 1023 |
| 30315 | 1023 |
| 30316 | 1023 |
| 30317 | 1023 |
| 30318 | 1023 |
| 30319 | 1023 |
| 30320 | 1023 |
| 30321 | 1023 |
| 30322 | 1023 |
| 30323 | 1023 |
| 30324 | 1023 |
| 30325 | 1023 |
| 30326 | 1023 |
| 30327 | 1023 |
| 30328 | 1023 |
| 30329 | 1023 |
| 30330 | 1023 |
| 30331 | 1023 |
| 30332 | 1023 |
| 30333 | 1023 |
| 30334 | 1023 |
| 30335 | 1023 |
| 30336 | 1023 |
| 30337 | 1023 |
| 30338 | 1023 |
| 30339 | 1023 |
| 30340 | 1023 |
| 30341 | 1023 |
| 30342 | 1023 |
| 30343 | 1023 |
| 30344 | 1023 |
| 30345 | 1023 |
| 30346 | 0 |
| 30347 | 0 |
| 30348 | 0 |
| 30349 | 0 |
| 30350 | 0 |
| 30351 | 0 |
| 30352 | 0 |
| 30353 | 0 |
| 30354 | 0 |
| 30355 | 0 |
| 30356 | 0 |
| 30357 | 0 |
| 30358 | 0 |
| 30359 | 1023 |
| 30360 | 1023 |
| 30361 | 1023 |
| 30362 | 1023 |
| 30363 | 1023 |
| 30364 | 1023 |
| 30365 | 1023 |
| 30366 | 1023 |
| 30367 | 1023 |
| 30368 | 1023 |
| 30369 | 1023 |
| 30370 | 1023 |
| 30371 | 1023 |
| 30372 | 1023 |
| 30373 | 1023 |
| 30374 | 1023 |
| 30375 | 1023 |
| 30376 | 1023 |
| 30377 | 1023 |
| 30378 | 1023 |
| 30379 | 1023 |
| 30380 | 1023 |
| 30381 | 1023 |
| 30382 | 1023 |
| 30383 | 1023 |
| 30384 | 1023 |
| 30385 | 1023 |
| 30386 | 1023 |
| 30387 | 1023 |
| 30388 | 1023 |
| 30389 | 1023 |
| 30390 | 1023 |
| 30391 | 1023 |
| 30392 | 1023 |
| 30393 | 1023 |
| 30394 | 1023 |
| 30395 | 1023 |
| 30396 | 1023 |
| 30397 | 0 |
| 30398 | 0 |
| 30399 | 0 |
| 30400 | 0 |
| 30401 | 0 |
| 30402 | 0 |
| 30403 | 0 |
| 30404 | 0 |
| 30405 | 0 |
| 30406 | 0 |
| 30407 | 0 |
| 30408 | 0 |
| 30409 | 0 |
| 30410 | 1023 |
| 30411 | 1023 |
| 30412 | 1023 |
| 30413 | 1023 |
| 30414 | 1023 |
| 30415 | 1023 |
| 30416 | 1023 |
| 30417 | 1023 |
| 30418 | 1023 |
| 30419 | 1023 |
| 30420 | 1023 |
| 30421 | 1023 |
| 30422 | 1023 |
| 30423 | 1023 |
| 30424 | 1023 |
| 30425 | 1023 |
| 30426 | 1023 |
| 30427 | 1023 |
| 30428 | 1023 |
| 30429 | 1023 |
| 30430 | 1023 |
| 30431 | 1023 |
| 30432 | 1023 |
| 30433 | 1023 |
| 30434 | 1023 |
| 30435 | 1023 |
| 30436 | 1023 |
| 30437 | 1023 |
| 30438 | 1023 |
| 30439 | 1023 |
| 30440 | 1023 |
| 30441 | 1023 |
| 30442 | 1023 |
| 30443 | 1023 |
| 30444 | 1023 |
| 30445 | 1023 |
| 30446 | 1023 |
| 30447 | 1023 |
| 30448 | 0 |
| 30449 | 0 |
| 30450 | 0 |
| 30451 | 0 |
| 30452 | 0 |
| 30453 | 0 |
| 30454 | 0 |
| 30455 | 0 |
| 30456 | 0 |
| 30457 | 0 |
| 30458 | 0 |
| 30459 | 0 |
| 30460 | 0 |
| 30461 | 1023 |
| 30462 | 1023 |
| 30463 | 1023 |
| 30464 | 1023 |
| 30465 | 1023 |
| 30466 | 1023 |
| 30467 | 1023 |
| 30468 | 1023 |
| 30469 | 1023 |
| 30470 | 1023 |
| 30471 | 1023 |
| 30472 | 1023 |
| 30473 | 1023 |
| 30474 | 1023 |
| 30475 | 1023 |
| 30476 | 1023 |
| 30477 | 1023 |
| 30478 | 1023 |
| 30479 | 1023 |
| 30480 | 1023 |
| 30481 | 1023 |
| 30482 | 1023 |
| 30483 | 1023 |
| 30484 | 1023 |
| 30485 | 1023 |
| 30486 | 1023 |
| 30487 | 1023 |
| 30488 | 1023 |
| 30489 | 1023 |
| 30490 | 1023 |
| 30491 | 1023 |
| 30492 | 1023 |
| 30493 | 1023 |
| 30494 | 1023 |
| 30495 | 1023 |
| 30496 | 1023 |
| 30497 | 1023 |
| 30498 | 1023 |
| 30499 | 0 |
| 30500 | 0 |
| 30501 | 0 |
| 30502 | 0 |
| 30503 | 0 |
| 30504 | 0 |
| 30505 | 0 |
| 30506 | 0 |
| 30507 | 0 |
| 30508 | 0 |
| 30509 | 0 |
| 30510 | 0 |
| 30511 | 0 |
| 30512 | 1023 |
| 30513 | 1023 |
| 30514 | 1023 |
| 30515 | 1023 |
| 30516 | 1023 |
| 30517 | 1023 |
| 30518 | 1023 |
| 30519 | 1023 |
| 30520 | 1023 |
| 30521 | 1023 |
| 30522 | 1023 |
| 30523 | 1023 |
| 30524 | 1023 |
| 30525 | 1023 |
| 30526 | 1023 |
| 30527 | 1023 |
| 30528 | 1023 |
| 30529 | 1023 |
| 30530 | 1023 |
| 30531 | 1023 |
| 30532 | 1023 |
| 30533 | 1023 |
| 30534 | 1023 |
| 30535 | 1023 |
| 30536 | 1023 |
| 30537 | 1023 |
| 30538 | 1023 |
| 30539 | 1023 |
| 30540 | 1023 |
| 30541 | 1023 |
| 30542 | 1023 |
| 30543 | 1023 |
| 30544 | 1023 |
| 30545 | 1023 |
| 30546 | 1023 |
| 30547 | 1023 |
| 30548 | 1023 |
| 30549 | 1023 |
| 30550 | 0 |
| 30551 | 0 |
| 30552 | 0 |
| 30553 | 0 |
| 30554 | 0 |
| 30555 | 0 |
| 30556 | 0 |
| 30557 | 0 |
| 30558 | 0 |
| 30559 | 0 |
| 30560 | 0 |
| 30561 | 0 |
| 30562 | 0 |
| 30563 | 1023 |
| 30564 | 1023 |
| 30565 | 1023 |
| 30566 | 1023 |
| 30567 | 1023 |
| 30568 | 1023 |
| 30569 | 1023 |
| 30570 | 1023 |
| 30571 | 1023 |
| 30572 | 1023 |
| 30573 | 1023 |
| 30574 | 1023 |
| 30575 | 1023 |
| 30576 | 1023 |
| 30577 | 1023 |
| 30578 | 1023 |
| 30579 | 1023 |
| 30580 | 1023 |
| 30581 | 1023 |
| 30582 | 1023 |
| 30583 | 1023 |
| 30584 | 1023 |
| 30585 | 1023 |
| 30586 | 1023 |
| 30587 | 1023 |
| 30588 | 1023 |
| 30589 | 1023 |
| 30590 | 1023 |
| 30591 | 1023 |
| 30592 | 1023 |
| 30593 | 1023 |
| 30594 | 1023 |
| 30595 | 1023 |
| 30596 | 1023 |
| 30597 | 1023 |
| 30598 | 1023 |
| 30599 | 1023 |
| 30600 | 1023 |
| 30601 | 0 |
| 30602 | 0 |
| 30603 | 0 |
| 30604 | 0 |
| 30605 | 0 |
| 30606 | 0 |
| 30607 | 0 |
| 30608 | 0 |
| 30609 | 0 |
| 30610 | 0 |
| 30611 | 0 |
| 30612 | 1 |
| 30613 | 0 |
| 30614 | 1023 |
| 30615 | 1023 |
| 30616 | 1023 |
| 30617 | 1023 |
| 30618 | 1023 |
| 30619 | 1023 |
| 30620 | 1023 |
| 30621 | 1023 |
| 30622 | 1023 |
| 30623 | 1023 |
| 30624 | 1023 |
| 30625 | 1023 |
| 30626 | 1023 |
| 30627 | 1023 |
| 30628 | 1023 |
| 30629 | 1023 |
| 30630 | 1023 |
| 30631 | 1023 |
| 30632 | 1023 |
| 30633 | 1023 |
| 30634 | 1023 |
| 30635 | 1023 |
| 30636 | 1023 |
| 30637 | 1023 |
| 30638 | 1023 |
| 30639 | 1023 |
| 30640 | 1023 |
| 30641 | 1023 |
| 30642 | 1023 |
| 30643 | 1023 |
| 30644 | 1023 |
| 30645 | 1023 |
| 30646 | 1023 |
| 30647 | 1023 |
| 30648 | 1023 |
| 30649 | 1023 |
| 30650 | 1023 |
| 30651 | 1023 |
| 30652 | 0 |
| 30653 | 0 |
| 30654 | 0 |
| 30655 | 0 |
| 30656 | 0 |
| 30657 | 0 |
| 30658 | 0 |
| 30659 | 0 |
| 30660 | 0 |
| 30661 | 0 |
| 30662 | 0 |
| 30663 | 0 |
| 30664 | 0 |
| 30665 | 0 |
| 30666 | 1023 |
| 30667 | 1023 |
| 30668 | 1023 |
| 30669 | 1023 |
| 30670 | 1023 |
| 30671 | 1023 |
| 30672 | 1023 |
| 30673 | 1023 |
| 30674 | 1023 |
| 30675 | 1023 |
| 30676 | 1023 |
| 30677 | 1023 |
| 30678 | 1023 |
| 30679 | 1023 |
| 30680 | 1023 |
| 30681 | 1023 |
| 30682 | 1023 |
| 30683 | 1023 |
| 30684 | 1023 |
| 30685 | 1023 |
| 30686 | 1023 |
| 30687 | 1023 |
| 30688 | 1023 |
| 30689 | 1023 |
| 30690 | 1023 |
| 30691 | 1023 |
| 30692 | 1023 |
| 30693 | 1023 |
| 30694 | 1023 |
| 30695 | 1023 |
| 30696 | 1023 |
| 30697 | 1023 |
| 30698 | 1023 |
| 30699 | 1023 |
| 30700 | 1023 |
| 30701 | 1023 |
| 30702 | 1023 |
| 30703 | 0 |
| 30704 | 0 |
| 30705 | 0 |
| 30706 | 0 |
| 30707 | 0 |
| 30708 | 0 |
| 30709 | 0 |
| 30710 | 0 |
| 30711 | 0 |
| 30712 | 0 |
| 30713 | 0 |
| 30714 | 0 |
| 30715 | 0 |
| 30716 | 0 |
| 30717 | 0 |
| 30718 | 1023 |
| 30719 | 1023 |
| 30720 | 1023 |
| 30721 | 1023 |
| 30722 | 1023 |
| 30723 | 1023 |
| 30724 | 1023 |
| 30725 | 1023 |
| 30726 | 1023 |
| 30727 | 1023 |
| 30728 | 1023 |
| 30729 | 1023 |
| 30730 | 1023 |
| 30731 | 1023 |
| 30732 | 1023 |
| 30733 | 1023 |
| 30734 | 1023 |
| 30735 | 1023 |
| 30736 | 1023 |
| 30737 | 1023 |
| 30738 | 1023 |
| 30739 | 1023 |
| 30740 | 1023 |
| 30741 | 1023 |
| 30742 | 1023 |
| 30743 | 1023 |
| 30744 | 1023 |
| 30745 | 1023 |
| 30746 | 1023 |
| 30747 | 1023 |
| 30748 | 1023 |
| 30749 | 1023 |
| 30750 | 1023 |
| 30751 | 1023 |
| 30752 | 1023 |
| 30753 | 1023 |
| 30754 | 1023 |
| 30755 | 0 |
| 30756 | 0 |
| 30757 | 0 |
| 30758 | 0 |
| 30759 | 0 |
| 30760 | 0 |
| 30761 | 0 |
| 30762 | 0 |
| 30763 | 0 |
| 30764 | 0 |
| 30765 | 0 |
| 30766 | 0 |
| 30767 | 0 |
| 30768 | 0 |
| 30769 | 0 |
| 30770 | 1023 |
| 30771 | 1023 |
| 30772 | 1023 |
| 30773 | 1023 |
| 30774 | 1023 |
| 30775 | 1023 |
| 30776 | 1023 |
| 30777 | 1023 |
| 30778 | 1023 |
| 30779 | 1023 |
| 30780 | 1023 |
| 30781 | 1023 |
| 30782 | 1023 |
| 30783 | 1023 |
| 30784 | 1023 |
| 30785 | 1023 |
| 30786 | 1023 |
| 30787 | 1023 |
| 30788 | 1023 |
| 30789 | 1023 |
| 30790 | 1023 |
| 30791 | 1023 |
| 30792 | 1023 |
| 30793 | 1023 |
| 30794 | 1023 |
| 30795 | 1023 |
| 30796 | 1023 |
| 30797 | 1023 |
| 30798 | 1023 |
| 30799 | 1023 |
| 30800 | 1023 |
| 30801 | 1023 |
| 30802 | 1023 |
| 30803 | 1023 |
| 30804 | 1023 |
| 30805 | 1023 |
| 30806 | 1023 |
| 30807 | 0 |
| 30808 | 0 |
| 30809 | 0 |
| 30810 | 0 |
| 30811 | 0 |
| 30812 | 0 |
| 30813 | 0 |
| 30814 | 0 |
| 30815 | 0 |
| 30816 | 0 |
| 30817 | 0 |
| 30818 | 0 |
| 30819 | 0 |
| 30820 | 0 |
| 30821 | 0 |
| 30822 | 1023 |
| 30823 | 1023 |
| 30824 | 1023 |
| 30825 | 1023 |
| 30826 | 1023 |
| 30827 | 1023 |
| 30828 | 1023 |
| 30829 | 1023 |
| 30830 | 1023 |
| 30831 | 1023 |
| 30832 | 1023 |
| 30833 | 1023 |
| 30834 | 1023 |
| 30835 | 1023 |
| 30836 | 1023 |
| 30837 | 1023 |
| 30838 | 1023 |
| 30839 | 1023 |
| 30840 | 1023 |
| 30841 | 1023 |
| 30842 | 1023 |
| 30843 | 1023 |
| 30844 | 1023 |
| 30845 | 1023 |
| 30846 | 1023 |
| 30847 | 1023 |
| 30848 | 1023 |
| 30849 | 1023 |
| 30850 | 1023 |
| 30851 | 1023 |
| 30852 | 1023 |
| 30853 | 1023 |
| 30854 | 1023 |
| 30855 | 1023 |
| 30856 | 1023 |
| 30857 | 1023 |
| 30858 | 1023 |
| 30859 | 0 |
| 30860 | 0 |
| 30861 | 0 |
| 30862 | 0 |
| 30863 | 0 |
| 30864 | 0 |
| 30865 | 0 |
| 30866 | 0 |
| 30867 | 0 |
| 30868 | 0 |
| 30869 | 0 |
| 30870 | 0 |
| 30871 | 0 |
| 30872 | 0 |
| 30873 | 0 |
| 30874 | 1023 |
| 30875 | 1023 |
| 30876 | 1023 |
| 30877 | 1023 |
| 30878 | 1023 |
| 30879 | 1023 |
| 30880 | 1023 |
| 30881 | 1023 |
| 30882 | 1023 |
| 30883 | 1023 |
| 30884 | 1023 |
| 30885 | 1023 |
| 30886 | 1023 |
| 30887 | 1023 |
| 30888 | 1023 |
| 30889 | 1023 |
| 30890 | 1023 |
| 30891 | 1023 |
| 30892 | 1023 |
| 30893 | 1023 |
| 30894 | 1023 |
| 30895 | 1023 |
| 30896 | 1023 |
| 30897 | 1023 |
| 30898 | 1023 |
| 30899 | 1023 |
| 30900 | 1023 |
| 30901 | 1023 |
| 30902 | 1023 |
| 30903 | 1023 |
| 30904 | 1023 |
| 30905 | 1023 |
| 30906 | 1023 |
| 30907 | 1023 |
| 30908 | 1023 |
| 30909 | 1023 |
| 30910 | 1023 |
| 30911 | 1023 |
| 30912 | 0 |
| 30913 | 0 |
| 30914 | 0 |
| 30915 | 0 |
| 30916 | 0 |
| 30917 | 0 |
| 30918 | 0 |
| 30919 | 0 |
| 30920 | 0 |
| 30921 | 0 |
| 30922 | 0 |
| 30923 | 0 |
| 30924 | 0 |
| 30925 | 1023 |
| 30926 | 1023 |
| 30927 | 1023 |
| 30928 | 1023 |
| 30929 | 1023 |
| 30930 | 1023 |
| 30931 | 1023 |
| 30932 | 1023 |
| 30933 | 1023 |
| 30934 | 1023 |
| 30935 | 1023 |
| 30936 | 1023 |
| 30937 | 1023 |
| 30938 | 1023 |
| 30939 | 1023 |
| 30940 | 1023 |
| 30941 | 1023 |
| 30942 | 1023 |
| 30943 | 1023 |
| 30944 | 1023 |
| 30945 | 1023 |
| 30946 | 1023 |
| 30947 | 1023 |
| 30948 | 1023 |
| 30949 | 1023 |
| 30950 | 1023 |
| 30951 | 1023 |
| 30952 | 1023 |
| 30953 | 1023 |
| 30954 | 1023 |
| 30955 | 1023 |
| 30956 | 1023 |
| 30957 | 1023 |
| 30958 | 1023 |
| 30959 | 1023 |
| 30960 | 1023 |
| 30961 | 1023 |
| 30962 | 1023 |
| 30963 | 0 |
| 30964 | 0 |
| 30965 | 0 |
| 30966 | 0 |
| 30967 | 0 |
| 30968 | 0 |
| 30969 | 0 |
| 30970 | 0 |
| 30971 | 0 |
| 30972 | 0 |
| 30973 | 0 |
| 30974 | 0 |
| 30975 | 0 |
| 30976 | 1023 |
| 30977 | 1023 |
| 30978 | 1023 |
| 30979 | 1023 |
| 30980 | 1023 |
| 30981 | 1023 |
| 30982 | 1023 |
| 30983 | 1023 |
| 30984 | 1023 |
| 30985 | 1023 |
| 30986 | 1023 |
| 30987 | 1023 |
| 30988 | 1023 |
| 30989 | 1023 |
| 30990 | 1023 |
| 30991 | 1023 |
| 30992 | 1023 |
| 30993 | 1023 |
| 30994 | 1023 |
| 30995 | 1023 |
| 30996 | 1023 |
| 30997 | 1023 |
| 30998 | 1023 |
| 30999 | 1023 |
| 31000 | 1023 |
| 31001 | 1023 |
| 31002 | 1023 |
| 31003 | 1023 |
| 31004 | 1023 |
| 31005 | 1023 |
| 31006 | 1023 |
| 31007 | 1023 |
| 31008 | 1023 |
| 31009 | 1023 |
| 31010 | 1023 |
| 31011 | 1023 |
| 31012 | 1023 |
| 31013 | 1023 |
| 31014 | 0 |
| 31015 | 0 |
| 31016 | 0 |
| 31017 | 0 |
| 31018 | 0 |
| 31019 | 0 |
| 31020 | 0 |
| 31021 | 0 |
| 31022 | 0 |
| 31023 | 0 |
| 31024 | 0 |
| 31025 | 0 |
| 31026 | 0 |
| 31027 | 1023 |
| 31028 | 1023 |
| 31029 | 1023 |
| 31030 | 1023 |
| 31031 | 1023 |
| 31032 | 1023 |
| 31033 | 1023 |
| 31034 | 1023 |
| 31035 | 1023 |
| 31036 | 1023 |
| 31037 | 1023 |
| 31038 | 1023 |
| 31039 | 1023 |
| 31040 | 1023 |
| 31041 | 1023 |
| 31042 | 1023 |
| 31043 | 1023 |
| 31044 | 1023 |
| 31045 | 1023 |
| 31046 | 1023 |
| 31047 | 1023 |
| 31048 | 1023 |
| 31049 | 1023 |
| 31050 | 1023 |
| 31051 | 1023 |
| 31052 | 1023 |
| 31053 | 1023 |
| 31054 | 1023 |
| 31055 | 1023 |
| 31056 | 1023 |
| 31057 | 1023 |
| 31058 | 1023 |
| 31059 | 1023 |
| 31060 | 1023 |
| 31061 | 1023 |
| 31062 | 1023 |
| 31063 | 1023 |
| 31064 | 1023 |
| 31065 | 0 |
| 31066 | 0 |
| 31067 | 0 |
| 31068 | 0 |
| 31069 | 0 |
| 31070 | 0 |
| 31071 | 0 |
| 31072 | 0 |
| 31073 | 0 |
| 31074 | 0 |
| 31075 | 0 |
| 31076 | 0 |
| 31077 | 0 |
| 31078 | 1023 |
| 31079 | 1023 |
| 31080 | 1023 |
| 31081 | 1023 |
| 31082 | 1023 |
| 31083 | 1023 |
| 31084 | 1023 |
| 31085 | 1023 |
| 31086 | 1023 |
| 31087 | 1023 |
| 31088 | 1023 |
| 31089 | 1023 |
| 31090 | 1023 |
| 31091 | 1023 |
| 31092 | 1023 |
| 31093 | 1023 |
| 31094 | 1023 |
| 31095 | 1023 |
| 31096 | 1023 |
| 31097 | 1023 |
| 31098 | 1023 |
| 31099 | 1023 |
| 31100 | 1023 |
| 31101 | 1023 |
| 31102 | 1023 |
| 31103 | 1023 |
| 31104 | 1023 |
| 31105 | 1023 |
| 31106 | 1023 |
| 31107 | 1023 |
| 31108 | 1023 |
| 31109 | 1023 |
| 31110 | 1023 |
| 31111 | 1023 |
| 31112 | 1023 |
| 31113 | 1023 |
| 31114 | 1023 |
| 31115 | 1023 |
| 31116 | 0 |
| 31117 | 0 |
| 31118 | 0 |
| 31119 | 0 |
| 31120 | 0 |
| 31121 | 0 |
| 31122 | 0 |
| 31123 | 0 |
| 31124 | 0 |
| 31125 | 0 |
| 31126 | 0 |
| 31127 | 0 |
| 31128 | 0 |
| 31129 | 1023 |
| 31130 | 1023 |
| 31131 | 1023 |
| 31132 | 1023 |
| 31133 | 1023 |
| 31134 | 1023 |
| 31135 | 1023 |
| 31136 | 1023 |
| 31137 | 1023 |
| 31138 | 1023 |
| 31139 | 1023 |
| 31140 | 1023 |
| 31141 | 1023 |
| 31142 | 1023 |
| 31143 | 1023 |
| 31144 | 1023 |
| 31145 | 1023 |
| 31146 | 1023 |
| 31147 | 1023 |
| 31148 | 1023 |
| 31149 | 1023 |
| 31150 | 1023 |
| 31151 | 1023 |
| 31152 | 1023 |
| 31153 | 1023 |
| 31154 | 1023 |
| 31155 | 1023 |
| 31156 | 1023 |
| 31157 | 1023 |
| 31158 | 1023 |
| 31159 | 1023 |
| 31160 | 1023 |
| 31161 | 1023 |
| 31162 | 1023 |
| 31163 | 1023 |
| 31164 | 1023 |
| 31165 | 1023 |
| 31166 | 1023 |
| 31167 | 0 |
| 31168 | 0 |
| 31169 | 0 |
| 31170 | 0 |
| 31171 | 0 |
| 31172 | 0 |
| 31173 | 0 |
| 31174 | 0 |
| 31175 | 0 |
| 31176 | 0 |
| 31177 | 0 |
| 31178 | 0 |
| 31179 | 0 |
| 31180 | 1023 |
| 31181 | 1023 |
| 31182 | 1023 |
| 31183 | 1023 |
| 31184 | 1023 |
| 31185 | 1023 |
| 31186 | 1023 |
| 31187 | 1023 |
| 31188 | 1023 |
| 31189 | 1023 |
| 31190 | 1023 |
| 31191 | 1023 |
| 31192 | 1023 |
| 31193 | 1023 |
| 31194 | 1023 |
| 31195 | 1023 |
| 31196 | 1023 |
| 31197 | 1023 |
| 31198 | 1023 |
| 31199 | 1023 |
| 31200 | 1023 |
| 31201 | 1023 |
| 31202 | 1023 |
| 31203 | 1023 |
| 31204 | 1023 |
| 31205 | 1023 |
| 31206 | 1023 |
| 31207 | 1023 |
| 31208 | 1023 |
| 31209 | 1023 |
| 31210 | 1023 |
| 31211 | 1023 |
| 31212 | 1023 |
| 31213 | 1023 |
| 31214 | 1023 |
| 31215 | 1023 |
| 31216 | 1023 |
| 31217 | 1023 |
| 31218 | 0 |
| 31219 | 0 |
| 31220 | 0 |
| 31221 | 0 |
| 31222 | 0 |
| 31223 | 0 |
| 31224 | 0 |
| 31225 | 0 |
| 31226 | 0 |
| 31227 | 0 |
| 31228 | 0 |
| 31229 | 0 |
| 31230 | 0 |
| 31231 | 1023 |
| 31232 | 1023 |
| 31233 | 1023 |
| 31234 | 1023 |
| 31235 | 1023 |
| 31236 | 1023 |
| 31237 | 1023 |
| 31238 | 1023 |
| 31239 | 1023 |
| 31240 | 1023 |
| 31241 | 1023 |
| 31242 | 1023 |
| 31243 | 1023 |
| 31244 | 1023 |
| 31245 | 1023 |
| 31246 | 1023 |
| 31247 | 1023 |
| 31248 | 1023 |
| 31249 | 1023 |
| 31250 | 1023 |
| 31251 | 1023 |
| 31252 | 1023 |
| 31253 | 1023 |
| 31254 | 1023 |
| 31255 | 1023 |
| 31256 | 1023 |
| 31257 | 1023 |
| 31258 | 1023 |
| 31259 | 1023 |
| 31260 | 1023 |
| 31261 | 1023 |
| 31262 | 1023 |
| 31263 | 1023 |
| 31264 | 1023 |
| 31265 | 1023 |
| 31266 | 1023 |
| 31267 | 1023 |
| 31268 | 1023 |
| 31269 | 0 |
| 31270 | 0 |
| 31271 | 0 |
| 31272 | 0 |
| 31273 | 0 |
| 31274 | 0 |
| 31275 | 0 |
| 31276 | 0 |
| 31277 | 0 |
| 31278 | 0 |
| 31279 | 0 |
| 31280 | 0 |
| 31281 | 0 |
| 31282 | 0 |
| 31283 | 1023 |
| 31284 | 1023 |
| 31285 | 1023 |
| 31286 | 1023 |
| 31287 | 1023 |
| 31288 | 1023 |
| 31289 | 1023 |
| 31290 | 1023 |
| 31291 | 1023 |
| 31292 | 1023 |
| 31293 | 1023 |
| 31294 | 1023 |
| 31295 | 1023 |
| 31296 | 1023 |
| 31297 | 1023 |
| 31298 | 1023 |
| 31299 | 1023 |
| 31300 | 1023 |
| 31301 | 1023 |
| 31302 | 1023 |
| 31303 | 1023 |
| 31304 | 1023 |
| 31305 | 1023 |
| 31306 | 1023 |
| 31307 | 1023 |
| 31308 | 1023 |
| 31309 | 1023 |
| 31310 | 1023 |
| 31311 | 1023 |
| 31312 | 1023 |
| 31313 | 1023 |
| 31314 | 1023 |
| 31315 | 1023 |
| 31316 | 1023 |
| 31317 | 1023 |
| 31318 | 1023 |
| 31319 | 1023 |
| 31320 | 0 |
| 31321 | 0 |
| 31322 | 0 |
| 31323 | 0 |
| 31324 | 0 |
| 31325 | 0 |
| 31326 | 0 |
| 31327 | 0 |
| 31328 | 0 |
| 31329 | 0 |
| 31330 | 0 |
| 31331 | 0 |
| 31332 | 0 |
| 31333 | 0 |
| 31334 | 1023 |
| 31335 | 1023 |
| 31336 | 1023 |
| 31337 | 1023 |
| 31338 | 1023 |
| 31339 | 1023 |
| 31340 | 1023 |
| 31341 | 1023 |
| 31342 | 1023 |
| 31343 | 1023 |
| 31344 | 1023 |
| 31345 | 1023 |
| 31346 | 1023 |
| 31347 | 1023 |
| 31348 | 1023 |
| 31349 | 1023 |
| 31350 | 1023 |
| 31351 | 1023 |
| 31352 | 1023 |
| 31353 | 1023 |
| 31354 | 1023 |
| 31355 | 1023 |
| 31356 | 1023 |
| 31357 | 1023 |
| 31358 | 1023 |
| 31359 | 1023 |
| 31360 | 1023 |
| 31361 | 1023 |
| 31362 | 1023 |
| 31363 | 1023 |
| 31364 | 1023 |
| 31365 | 1023 |
| 31366 | 1023 |
| 31367 | 1023 |
| 31368 | 1023 |
| 31369 | 1023 |
| 31370 | 1023 |
| 31371 | 1023 |
| 31372 | 0 |
| 31373 | 0 |
| 31374 | 0 |
| 31375 | 0 |
| 31376 | 0 |
| 31377 | 0 |
| 31378 | 0 |
| 31379 | 0 |
| 31380 | 0 |
| 31381 | 0 |
| 31382 | 0 |
| 31383 | 0 |
| 31384 | 0 |
| 31385 | 0 |
| 31386 | 1023 |
| 31387 | 1023 |
| 31388 | 1023 |
| 31389 | 1023 |
| 31390 | 1023 |
| 31391 | 1023 |
| 31392 | 1023 |
| 31393 | 1023 |
| 31394 | 1023 |
| 31395 | 1023 |
| 31396 | 1023 |
| 31397 | 1023 |
| 31398 | 1023 |
| 31399 | 1023 |
| 31400 | 1023 |
| 31401 | 1023 |
| 31402 | 1023 |
| 31403 | 1023 |
| 31404 | 1023 |
| 31405 | 1023 |
| 31406 | 1023 |
| 31407 | 1023 |
| 31408 | 1023 |
| 31409 | 1023 |
| 31410 | 1023 |
| 31411 | 1023 |
| 31412 | 1023 |
| 31413 | 1023 |
| 31414 | 1023 |
| 31415 | 1023 |
| 31416 | 1023 |
| 31417 | 1023 |
| 31418 | 1023 |
| 31419 | 1023 |
| 31420 | 1023 |
| 31421 | 1023 |
| 31422 | 1023 |
| 31423 | 0 |
| 31424 | 0 |
| 31425 | 0 |
| 31426 | 0 |
| 31427 | 0 |
| 31428 | 0 |
| 31429 | 0 |
| 31430 | 0 |
| 31431 | 0 |
| 31432 | 0 |
| 31433 | 0 |
| 31434 | 0 |
| 31435 | 0 |
| 31436 | 0 |
| 31437 | 0 |
| 31438 | 1023 |
| 31439 | 1023 |
| 31440 | 1023 |
| 31441 | 1023 |
| 31442 | 1023 |
| 31443 | 1023 |
| 31444 | 1023 |
| 31445 | 1023 |
| 31446 | 1023 |
| 31447 | 1023 |
| 31448 | 1023 |
| 31449 | 1023 |
| 31450 | 1023 |
| 31451 | 1023 |
| 31452 | 1023 |
| 31453 | 1023 |
| 31454 | 1023 |
| 31455 | 1023 |
| 31456 | 1023 |
| 31457 | 1023 |
| 31458 | 1023 |
| 31459 | 1023 |
| 31460 | 1023 |
| 31461 | 1023 |
| 31462 | 1023 |
| 31463 | 1023 |
| 31464 | 1023 |
| 31465 | 1023 |
| 31466 | 1023 |
| 31467 | 1023 |
| 31468 | 1023 |
| 31469 | 1023 |
| 31470 | 1023 |
| 31471 | 1023 |
| 31472 | 1023 |
| 31473 | 1023 |
| 31474 | 1023 |
| 31475 | 0 |
| 31476 | 0 |
| 31477 | 0 |
| 31478 | 0 |
| 31479 | 0 |
| 31480 | 0 |
| 31481 | 0 |
| 31482 | 0 |
| 31483 | 0 |
| 31484 | 0 |
| 31485 | 0 |
| 31486 | 0 |
| 31487 | 0 |
| 31488 | 0 |
| 31489 | 0 |
| 31490 | 1023 |
| 31491 | 1023 |
| 31492 | 1023 |
| 31493 | 1023 |
| 31494 | 1023 |
| 31495 | 1023 |
| 31496 | 1023 |
| 31497 | 1023 |
| 31498 | 1023 |
| 31499 | 1023 |
| 31500 | 1023 |
| 31501 | 1023 |
| 31502 | 1023 |
| 31503 | 1023 |
| 31504 | 1023 |
| 31505 | 1023 |
| 31506 | 1023 |
| 31507 | 1023 |
| 31508 | 1023 |
| 31509 | 1023 |
| 31510 | 1023 |
| 31511 | 1023 |
| 31512 | 1023 |
| 31513 | 1023 |
| 31514 | 1023 |
| 31515 | 1023 |
| 31516 | 1023 |
| 31517 | 1023 |
| 31518 | 1023 |
| 31519 | 1023 |
| 31520 | 1023 |
| 31521 | 1023 |
| 31522 | 1023 |
| 31523 | 1023 |
| 31524 | 1023 |
| 31525 | 1023 |
| 31526 | 1023 |
| 31527 | 1023 |
| 31528 | 0 |
| 31529 | 0 |
| 31530 | 0 |
| 31531 | 0 |
| 31532 | 0 |
| 31533 | 0 |
| 31534 | 1 |
| 31535 | 0 |
| 31536 | 0 |
| 31537 | 0 |
| 31538 | 0 |
| 31539 | 0 |
| 31540 | 0 |
| 31541 | 1023 |
| 31542 | 1023 |
| 31543 | 1023 |
| 31544 | 1023 |
| 31545 | 1023 |
| 31546 | 1023 |
| 31547 | 1023 |
| 31548 | 1023 |
| 31549 | 1023 |
| 31550 | 1023 |
| 31551 | 1023 |
| 31552 | 1023 |
| 31553 | 1023 |
| 31554 | 1023 |
| 31555 | 1023 |
| 31556 | 1023 |
| 31557 | 1023 |
| 31558 | 1023 |
| 31559 | 1023 |
| 31560 | 1023 |
| 31561 | 1023 |
| 31562 | 1023 |
| 31563 | 1023 |
| 31564 | 1023 |
| 31565 | 1023 |
| 31566 | 1023 |
| 31567 | 1023 |
| 31568 | 1023 |
| 31569 | 1023 |
| 31570 | 1023 |
| 31571 | 1023 |
| 31572 | 1023 |
| 31573 | 1023 |
| 31574 | 1023 |
| 31575 | 1023 |
| 31576 | 1023 |
| 31577 | 1023 |
| 31578 | 1023 |
| 31579 | 0 |
| 31580 | 0 |
| 31581 | 0 |
| 31582 | 0 |
| 31583 | 0 |
| 31584 | 0 |
| 31585 | 0 |
| 31586 | 0 |
| 31587 | 0 |
| 31588 | 0 |
| 31589 | 0 |
| 31590 | 0 |
| 31591 | 0 |
| 31592 | 1023 |
| 31593 | 1023 |
| 31594 | 1023 |
| 31595 | 1023 |
| 31596 | 1023 |
| 31597 | 1023 |
| 31598 | 1023 |
| 31599 | 1023 |
| 31600 | 1023 |
| 31601 | 1023 |
| 31602 | 1023 |
| 31603 | 1023 |
| 31604 | 1023 |
| 31605 | 1023 |
| 31606 | 1023 |
| 31607 | 1023 |
| 31608 | 1023 |
| 31609 | 1023 |
| 31610 | 1023 |
| 31611 | 1023 |
| 31612 | 1023 |
| 31613 | 1023 |
| 31614 | 1023 |
| 31615 | 1023 |
| 31616 | 1023 |
| 31617 | 1023 |
| 31618 | 1023 |
| 31619 | 1023 |
| 31620 | 1023 |
| 31621 | 1023 |
| 31622 | 1023 |
| 31623 | 1023 |
| 31624 | 1023 |
| 31625 | 1023 |
| 31626 | 1023 |
| 31627 | 1023 |
| 31628 | 1023 |
| 31629 | 1023 |
| 31630 | 0 |
| 31631 | 0 |
| 31632 | 0 |
| 31633 | 0 |
| 31634 | 0 |
| 31635 | 0 |
| 31636 | 0 |
| 31637 | 0 |
| 31638 | 0 |
| 31639 | 0 |
| 31640 | 0 |
| 31641 | 0 |
| 31642 | 0 |
| 31643 | 1023 |
| 31644 | 1023 |
| 31645 | 1023 |
| 31646 | 1023 |
| 31647 | 1023 |
| 31648 | 1023 |
| 31649 | 1023 |
| 31650 | 1023 |
| 31651 | 1023 |
| 31652 | 1023 |
| 31653 | 1023 |
| 31654 | 1023 |
| 31655 | 1023 |
| 31656 | 1023 |
| 31657 | 1023 |
| 31658 | 1023 |
| 31659 | 1023 |
| 31660 | 1023 |
| 31661 | 1023 |
| 31662 | 1023 |
| 31663 | 1023 |
| 31664 | 1023 |
| 31665 | 1023 |
| 31666 | 1023 |
| 31667 | 1023 |
| 31668 | 1023 |
| 31669 | 1023 |
| 31670 | 1023 |
| 31671 | 1023 |
| 31672 | 1023 |
| 31673 | 1023 |
| 31674 | 1023 |
| 31675 | 1023 |
| 31676 | 1023 |
| 31677 | 1023 |
| 31678 | 1023 |
| 31679 | 1023 |
| 31680 | 1023 |
| 31681 | 0 |
| 31682 | 0 |
| 31683 | 0 |
| 31684 | 0 |
| 31685 | 0 |
| 31686 | 0 |
| 31687 | 0 |
| 31688 | 0 |
| 31689 | 0 |
| 31690 | 0 |
| 31691 | 0 |
| 31692 | 0 |
| 31693 | 0 |
| 31694 | 1023 |
| 31695 | 1023 |
| 31696 | 1023 |
| 31697 | 1023 |
| 31698 | 1023 |
| 31699 | 1023 |
| 31700 | 1023 |
| 31701 | 1023 |
| 31702 | 1023 |
| 31703 | 1023 |
| 31704 | 1023 |
| 31705 | 1023 |
| 31706 | 1023 |
| 31707 | 1023 |
| 31708 | 1023 |
| 31709 | 1023 |
| 31710 | 1023 |
| 31711 | 1023 |
| 31712 | 1023 |
| 31713 | 1023 |
| 31714 | 1023 |
| 31715 | 1023 |
| 31716 | 1023 |
| 31717 | 1023 |
| 31718 | 1023 |
| 31719 | 1023 |
| 31720 | 1023 |
| 31721 | 1023 |
| 31722 | 1023 |
| 31723 | 1023 |
| 31724 | 1023 |
| 31725 | 1023 |
| 31726 | 1023 |
| 31727 | 1023 |
| 31728 | 1023 |
| 31729 | 1023 |
| 31730 | 1023 |
| 31731 | 1023 |
| 31732 | 0 |
| 31733 | 0 |
| 31734 | 0 |
| 31735 | 0 |
| 31736 | 0 |
| 31737 | 0 |
| 31738 | 0 |
| 31739 | 0 |
| 31740 | 0 |
| 31741 | 0 |
| 31742 | 0 |
| 31743 | 0 |
| 31744 | 0 |
| 31745 | 1023 |
| 31746 | 1023 |
| 31747 | 1023 |
| 31748 | 1023 |
| 31749 | 1023 |
| 31750 | 1023 |
| 31751 | 1023 |
| 31752 | 1023 |
| 31753 | 1023 |
| 31754 | 1023 |
| 31755 | 1023 |
| 31756 | 1023 |
| 31757 | 1023 |
| 31758 | 1023 |
| 31759 | 1023 |
| 31760 | 1023 |
| 31761 | 1023 |
| 31762 | 1023 |
| 31763 | 1023 |
| 31764 | 1023 |
| 31765 | 1023 |
| 31766 | 1023 |
| 31767 | 1023 |
| 31768 | 1023 |
| 31769 | 1023 |
| 31770 | 1023 |
| 31771 | 1023 |
| 31772 | 1023 |
| 31773 | 1023 |
| 31774 | 1023 |
| 31775 | 1023 |
| 31776 | 1023 |
| 31777 | 1023 |
| 31778 | 1023 |
| 31779 | 1023 |
| 31780 | 1023 |
| 31781 | 1023 |
| 31782 | 1023 |
| 31783 | 0 |
| 31784 | 0 |
| 31785 | 0 |
| 31786 | 0 |
| 31787 | 0 |
| 31788 | 0 |
| 31789 | 0 |
| 31790 | 0 |
| 31791 | 0 |
| 31792 | 0 |
| 31793 | 0 |
| 31794 | 0 |
| 31795 | 1 |
| 31796 | 1023 |
| 31797 | 1023 |
| 31798 | 1023 |
| 31799 | 1023 |
| 31800 | 1023 |
| 31801 | 1023 |
| 31802 | 1023 |
| 31803 | 1023 |
| 31804 | 1023 |
| 31805 | 1023 |
| 31806 | 1023 |
| 31807 | 1023 |
| 31808 | 1023 |
| 31809 | 1023 |
| 31810 | 1023 |
| 31811 | 1023 |
| 31812 | 1023 |
| 31813 | 1023 |
| 31814 | 1023 |
| 31815 | 1023 |
| 31816 | 1023 |
| 31817 | 1023 |
| 31818 | 1023 |
| 31819 | 1023 |
| 31820 | 1023 |
| 31821 | 1023 |
| 31822 | 1023 |
| 31823 | 1023 |
| 31824 | 1023 |
| 31825 | 1023 |
| 31826 | 1023 |
| 31827 | 1023 |
| 31828 | 1023 |
| 31829 | 1023 |
| 31830 | 1023 |
| 31831 | 1023 |
| 31832 | 1023 |
| 31833 | 1023 |
| 31834 | 0 |
| 31835 | 0 |
| 31836 | 0 |
| 31837 | 0 |
| 31838 | 0 |
| 31839 | 0 |
| 31840 | 0 |
| 31841 | 0 |
| 31842 | 0 |
| 31843 | 0 |
| 31844 | 0 |
| 31845 | 0 |
| 31846 | 0 |
| 31847 | 0 |
| 31848 | 1023 |
| 31849 | 1023 |
| 31850 | 1023 |
| 31851 | 1023 |
| 31852 | 1023 |
| 31853 | 1023 |
| 31854 | 1023 |
| 31855 | 1023 |
| 31856 | 1023 |
| 31857 | 1023 |
| 31858 | 1023 |
| 31859 | 1023 |
| 31860 | 1023 |
| 31861 | 1023 |
| 31862 | 1023 |
| 31863 | 1023 |
| 31864 | 1023 |
| 31865 | 1023 |
| 31866 | 1023 |
| 31867 | 1023 |
| 31868 | 1023 |
| 31869 | 1023 |
| 31870 | 1023 |
| 31871 | 1023 |
| 31872 | 1023 |
| 31873 | 1023 |
| 31874 | 1023 |
| 31875 | 1023 |
| 31876 | 1023 |
| 31877 | 1023 |
| 31878 | 1023 |
| 31879 | 1023 |
| 31880 | 1023 |
| 31881 | 1023 |
| 31882 | 1023 |
| 31883 | 1023 |
| 31884 | 1023 |
| 31885 | 0 |
| 31886 | 0 |
| 31887 | 0 |
| 31888 | 0 |
| 31889 | 0 |
| 31890 | 0 |
| 31891 | 0 |
| 31892 | 0 |
| 31893 | 0 |
| 31894 | 0 |
| 31895 | 0 |
| 31896 | 0 |
| 31897 | 0 |
| 31898 | 0 |
| 31899 | 1023 |
| 31900 | 1023 |
| 31901 | 1023 |
| 31902 | 1023 |
| 31903 | 1023 |
| 31904 | 1023 |
| 31905 | 1023 |
| 31906 | 1023 |
| 31907 | 1023 |
| 31908 | 1023 |
| 31909 | 1023 |
| 31910 | 1023 |
| 31911 | 1023 |
| 31912 | 1023 |
| 31913 | 1023 |
| 31914 | 1023 |
| 31915 | 1023 |
| 31916 | 1023 |
| 31917 | 1023 |
| 31918 | 1023 |
| 31919 | 1023 |
| 31920 | 1023 |
| 31921 | 1023 |
| 31922 | 1023 |
| 31923 | 1023 |
| 31924 | 1023 |
| 31925 | 1023 |
| 31926 | 1023 |
| 31927 | 1023 |
| 31928 | 1023 |
| 31929 | 1023 |
| 31930 | 1023 |
| 31931 | 1023 |
| 31932 | 1023 |
| 31933 | 1023 |
| 31934 | 1023 |
| 31935 | 1023 |
| 31936 | 1023 |
| 31937 | 0 |
| 31938 | 0 |
| 31939 | 0 |
| 31940 | 0 |
| 31941 | 0 |
| 31942 | 0 |
| 31943 | 0 |
| 31944 | 0 |
| 31945 | 0 |
| 31946 | 1 |
| 31947 | 0 |
| 31948 | 0 |
| 31949 | 0 |
| 31950 | 0 |
| 31951 | 1023 |
| 31952 | 1023 |
| 31953 | 1023 |
| 31954 | 1023 |
| 31955 | 1023 |
| 31956 | 1023 |
| 31957 | 1023 |
| 31958 | 1023 |
| 31959 | 1023 |
| 31960 | 1023 |
| 31961 | 1023 |
| 31962 | 1023 |
| 31963 | 1023 |
| 31964 | 1023 |
| 31965 | 1023 |
| 31966 | 1023 |
| 31967 | 1023 |
| 31968 | 1023 |
| 31969 | 1023 |
| 31970 | 1023 |
| 31971 | 1023 |
| 31972 | 1023 |
| 31973 | 1023 |
| 31974 | 1023 |
| 31975 | 1023 |
| 31976 | 1023 |
| 31977 | 1023 |
| 31978 | 1023 |
| 31979 | 1023 |
| 31980 | 1023 |
| 31981 | 1023 |
| 31982 | 1023 |
| 31983 | 1023 |
| 31984 | 1023 |
| 31985 | 1023 |
| 31986 | 1023 |
| 31987 | 1023 |
| 31988 | 0 |
| 31989 | 0 |
| 31990 | 0 |
| 31991 | 0 |
| 31992 | 0 |
| 31993 | 0 |
| 31994 | 0 |
| 31995 | 0 |
| 31996 | 0 |
| 31997 | 0 |
| 31998 | 0 |
| 31999 | 0 |
| 32000 | 0 |
| 32001 | 0 |
| 32002 | 0 |
| 32003 | 1023 |
| 32004 | 1023 |
| 32005 | 1023 |
| 32006 | 1023 |
| 32007 | 1023 |
| 32008 | 1023 |
| 32009 | 1023 |
| 32010 | 1023 |
| 32011 | 1023 |
| 32012 | 1023 |
| 32013 | 1023 |
| 32014 | 1023 |
| 32015 | 1023 |
| 32016 | 1023 |
| 32017 | 1023 |
| 32018 | 1023 |
| 32019 | 1023 |
| 32020 | 1023 |
| 32021 | 1023 |
| 32022 | 1023 |
| 32023 | 1023 |
| 32024 | 1023 |
| 32025 | 1023 |
| 32026 | 1023 |
| 32027 | 1023 |
| 32028 | 1023 |
| 32029 | 1023 |
| 32030 | 1023 |
| 32031 | 1023 |
| 32032 | 1023 |
| 32033 | 1023 |
| 32034 | 1023 |
| 32035 | 1023 |
| 32036 | 1023 |
| 32037 | 1023 |
| 32038 | 1023 |
| 32039 | 1023 |
| 32040 | 0 |
| 32041 | 0 |
| 32042 | 0 |
| 32043 | 0 |
| 32044 | 0 |
| 32045 | 0 |
| 32046 | 0 |
| 32047 | 0 |
| 32048 | 0 |
| 32049 | 0 |
| 32050 | 0 |
| 32051 | 0 |
| 32052 | 0 |
| 32053 | 0 |
| 32054 | 0 |
| 32055 | 1023 |
| 32056 | 1023 |
| 32057 | 1023 |
| 32058 | 1023 |
| 32059 | 1023 |
| 32060 | 1023 |
| 32061 | 1023 |
| 32062 | 1023 |
| 32063 | 1023 |
| 32064 | 1023 |
| 32065 | 1023 |
| 32066 | 1023 |
| 32067 | 1023 |
| 32068 | 1023 |
| 32069 | 1023 |
| 32070 | 1023 |
| 32071 | 1023 |
| 32072 | 1023 |
| 32073 | 1023 |
| 32074 | 1023 |
| 32075 | 1023 |
| 32076 | 1023 |
| 32077 | 1023 |
| 32078 | 1023 |
| 32079 | 1023 |
| 32080 | 1023 |
| 32081 | 1023 |
| 32082 | 1023 |
| 32083 | 1023 |
| 32084 | 1023 |
| 32085 | 1023 |
| 32086 | 1023 |
| 32087 | 1023 |
| 32088 | 1023 |
| 32089 | 1023 |
| 32090 | 1023 |
| 32091 | 1023 |
| 32092 | 0 |
| 32093 | 0 |
| 32094 | 0 |
| 32095 | 0 |
| 32096 | 0 |
| 32097 | 0 |
| 32098 | 0 |
| 32099 | 0 |
| 32100 | 0 |
| 32101 | 0 |
| 32102 | 0 |
| 32103 | 0 |
| 32104 | 0 |
| 32105 | 0 |
| 32106 | 0 |
| 32107 | 1023 |
| 32108 | 1023 |
| 32109 | 1023 |
| 32110 | 1023 |
| 32111 | 1023 |
| 32112 | 1023 |
| 32113 | 1023 |
| 32114 | 1023 |
| 32115 | 1023 |
| 32116 | 1023 |
| 32117 | 1023 |
| 32118 | 1023 |
| 32119 | 1023 |
| 32120 | 1023 |
| 32121 | 1023 |
| 32122 | 1023 |
| 32123 | 1023 |
| 32124 | 1023 |
| 32125 | 1023 |
| 32126 | 1023 |
| 32127 | 1023 |
| 32128 | 1023 |
| 32129 | 1023 |
| 32130 | 1023 |
| 32131 | 1023 |
| 32132 | 1023 |
| 32133 | 1023 |
| 32134 | 1023 |
| 32135 | 1023 |
| 32136 | 1023 |
| 32137 | 1023 |
| 32138 | 1023 |
| 32139 | 1023 |
| 32140 | 1023 |
| 32141 | 1023 |
| 32142 | 1023 |
| 32143 | 1023 |
| 32144 | 1023 |
| 32145 | 0 |
| 32146 | 0 |
| 32147 | 0 |
| 32148 | 0 |
| 32149 | 0 |
| 32150 | 0 |
| 32151 | 0 |
| 32152 | 0 |
| 32153 | 0 |
| 32154 | 0 |
| 32155 | 0 |
| 32156 | 0 |
| 32157 | 0 |
| 32158 | 1023 |
| 32159 | 1023 |
| 32160 | 1023 |
| 32161 | 1023 |
| 32162 | 1023 |
| 32163 | 1023 |
| 32164 | 1023 |
| 32165 | 1023 |
| 32166 | 1023 |
| 32167 | 1023 |
| 32168 | 1023 |
| 32169 | 1023 |
| 32170 | 1023 |
| 32171 | 1023 |
| 32172 | 1023 |
| 32173 | 1023 |
| 32174 | 1023 |
| 32175 | 1023 |
| 32176 | 1023 |
| 32177 | 1023 |
| 32178 | 1023 |
| 32179 | 1023 |
| 32180 | 1023 |
| 32181 | 1023 |
| 32182 | 1023 |
| 32183 | 1023 |
| 32184 | 1023 |
| 32185 | 1023 |
| 32186 | 1023 |
| 32187 | 1023 |
| 32188 | 1023 |
| 32189 | 1023 |
| 32190 | 1023 |
| 32191 | 1023 |
| 32192 | 1023 |
| 32193 | 1023 |
| 32194 | 1023 |
| 32195 | 1023 |
| 32196 | 0 |
| 32197 | 0 |
| 32198 | 0 |
| 32199 | 0 |
| 32200 | 0 |
| 32201 | 0 |
| 32202 | 0 |
| 32203 | 0 |
| 32204 | 0 |
| 32205 | 0 |
| 32206 | 0 |
| 32207 | 0 |
| 32208 | 0 |
| 32209 | 1023 |
| 32210 | 1023 |
| 32211 | 1023 |
| 32212 | 1023 |
| 32213 | 1023 |
| 32214 | 1023 |
| 32215 | 1023 |
| 32216 | 1023 |
| 32217 | 1023 |
| 32218 | 1023 |
| 32219 | 1023 |
| 32220 | 1023 |
| 32221 | 1023 |
| 32222 | 1023 |
| 32223 | 1023 |
| 32224 | 1023 |
| 32225 | 1023 |
| 32226 | 1023 |
| 32227 | 1023 |
| 32228 | 1023 |
| 32229 | 1023 |
| 32230 | 1023 |
| 32231 | 1023 |
| 32232 | 1023 |
| 32233 | 1023 |
| 32234 | 1023 |
| 32235 | 1023 |
| 32236 | 1023 |
| 32237 | 1023 |
| 32238 | 1023 |
| 32239 | 1023 |
| 32240 | 1023 |
| 32241 | 1023 |
| 32242 | 1023 |
| 32243 | 1023 |
| 32244 | 1023 |
| 32245 | 1023 |
| 32246 | 1023 |
| 32247 | 0 |
| 32248 | 0 |
| 32249 | 0 |
| 32250 | 0 |
| 32251 | 0 |
| 32252 | 0 |
| 32253 | 0 |
| 32254 | 0 |
| 32255 | 0 |
| 32256 | 0 |
| 32257 | 1 |
| 32258 | 0 |
| 32259 | 0 |
| 32260 | 1023 |
| 32261 | 1023 |
| 32262 | 1023 |
| 32263 | 1023 |
| 32264 | 1023 |
| 32265 | 1023 |
| 32266 | 1023 |
| 32267 | 1023 |
| 32268 | 1023 |
| 32269 | 1023 |
| 32270 | 1023 |
| 32271 | 1023 |
| 32272 | 1023 |
| 32273 | 1023 |
| 32274 | 1023 |
| 32275 | 1023 |
| 32276 | 1023 |
| 32277 | 1023 |
| 32278 | 1023 |
| 32279 | 1023 |
| 32280 | 1023 |
| 32281 | 1023 |
| 32282 | 1023 |
| 32283 | 1023 |
| 32284 | 1023 |
| 32285 | 1023 |
| 32286 | 1023 |
| 32287 | 1023 |
| 32288 | 1023 |
| 32289 | 1023 |
| 32290 | 1023 |
| 32291 | 1023 |
| 32292 | 1023 |
| 32293 | 1023 |
| 32294 | 1023 |
| 32295 | 1023 |
| 32296 | 1023 |
| 32297 | 1023 |
| 32298 | 0 |
| 32299 | 0 |
| 32300 | 0 |
| 32301 | 0 |
| 32302 | 0 |
| 32303 | 0 |
| 32304 | 0 |
| 32305 | 0 |
| 32306 | 0 |
| 32307 | 0 |
| 32308 | 0 |
| 32309 | 0 |
| 32310 | 0 |
| 32311 | 1023 |
| 32312 | 1023 |
| 32313 | 1023 |
| 32314 | 1023 |
| 32315 | 1023 |
| 32316 | 1023 |
| 32317 | 1023 |
| 32318 | 1023 |
| 32319 | 1023 |
| 32320 | 1023 |
| 32321 | 1023 |
| 32322 | 1023 |
| 32323 | 1023 |
| 32324 | 1023 |
| 32325 | 1023 |
| 32326 | 1023 |
| 32327 | 1023 |
| 32328 | 1023 |
| 32329 | 1023 |
| 32330 | 1023 |
| 32331 | 1023 |
| 32332 | 1023 |
| 32333 | 1023 |
| 32334 | 1023 |
| 32335 | 1023 |
| 32336 | 1023 |
| 32337 | 1023 |
| 32338 | 1023 |
| 32339 | 1023 |
| 32340 | 1023 |
| 32341 | 1023 |
| 32342 | 1023 |
| 32343 | 1023 |
| 32344 | 1023 |
| 32345 | 1023 |
| 32346 | 1023 |
| 32347 | 1023 |
| 32348 | 1023 |
| 32349 | 0 |
| 32350 | 0 |
| 32351 | 0 |
| 32352 | 0 |
| 32353 | 0 |
| 32354 | 0 |
| 32355 | 0 |
| 32356 | 0 |
| 32357 | 0 |
| 32358 | 0 |
| 32359 | 0 |
| 32360 | 0 |
| 32361 | 0 |
| 32362 | 1023 |
| 32363 | 1023 |
| 32364 | 1023 |
| 32365 | 1023 |
| 32366 | 1023 |
| 32367 | 1023 |
| 32368 | 1023 |
| 32369 | 1023 |
| 32370 | 1023 |
| 32371 | 1023 |
| 32372 | 1023 |
| 32373 | 1023 |
| 32374 | 1023 |
| 32375 | 1023 |
| 32376 | 1023 |
| 32377 | 1023 |
| 32378 | 1023 |
| 32379 | 1023 |
| 32380 | 1023 |
| 32381 | 1023 |
| 32382 | 1023 |
| 32383 | 1023 |
| 32384 | 1023 |
| 32385 | 1023 |
| 32386 | 1023 |
| 32387 | 1023 |
| 32388 | 1023 |
| 32389 | 1023 |
| 32390 | 1023 |
| 32391 | 1023 |
| 32392 | 1023 |
| 32393 | 1023 |
| 32394 | 1023 |
| 32395 | 1023 |
| 32396 | 1023 |
| 32397 | 1023 |
| 32398 | 1023 |
| 32399 | 1023 |
| 32400 | 0 |
| 32401 | 0 |
| 32402 | 0 |
| 32403 | 0 |
| 32404 | 0 |
| 32405 | 0 |
| 32406 | 0 |
| 32407 | 0 |
| 32408 | 0 |
| 32409 | 0 |
| 32410 | 0 |
| 32411 | 0 |
| 32412 | 0 |
| 32413 | 1023 |
| 32414 | 1023 |
| 32415 | 1023 |
| 32416 | 1023 |
| 32417 | 1023 |
| 32418 | 1023 |
| 32419 | 1023 |
| 32420 | 1023 |
| 32421 | 1023 |
| 32422 | 1023 |
| 32423 | 1023 |
| 32424 | 1023 |
| 32425 | 1023 |
| 32426 | 1023 |
| 32427 | 1023 |
| 32428 | 1023 |
| 32429 | 1023 |
| 32430 | 1023 |
| 32431 | 1023 |
| 32432 | 1023 |
| 32433 | 1023 |
| 32434 | 1023 |
| 32435 | 1023 |
| 32436 | 1023 |
| 32437 | 1023 |
| 32438 | 1023 |
| 32439 | 1023 |
| 32440 | 1023 |
| 32441 | 1023 |
| 32442 | 1023 |
| 32443 | 1023 |
| 32444 | 1023 |
| 32445 | 1023 |
| 32446 | 1023 |
| 32447 | 1023 |
| 32448 | 1023 |
| 32449 | 1023 |
| 32450 | 1023 |
| 32451 | 0 |
| 32452 | 0 |
| 32453 | 0 |
| 32454 | 0 |
| 32455 | 0 |
| 32456 | 0 |
| 32457 | 0 |
| 32458 | 0 |
| 32459 | 0 |
| 32460 | 0 |
| 32461 | 0 |
| 32462 | 0 |
| 32463 | 0 |
| 32464 | 0 |
| 32465 | 1023 |
| 32466 | 1023 |
| 32467 | 1023 |
| 32468 | 1023 |
| 32469 | 1023 |
| 32470 | 1023 |
| 32471 | 1023 |
| 32472 | 1023 |
| 32473 | 1023 |
| 32474 | 1023 |
| 32475 | 1023 |
| 32476 | 1023 |
| 32477 | 1023 |
| 32478 | 1023 |
| 32479 | 1023 |
| 32480 | 1023 |
| 32481 | 1023 |
| 32482 | 1023 |
| 32483 | 1023 |
| 32484 | 1023 |
| 32485 | 1023 |
| 32486 | 1023 |
| 32487 | 1023 |
| 32488 | 1023 |
| 32489 | 1023 |
| 32490 | 1023 |
| 32491 | 1023 |
| 32492 | 1023 |
| 32493 | 1023 |
| 32494 | 1023 |
| 32495 | 1023 |
| 32496 | 1023 |
| 32497 | 1023 |
| 32498 | 1023 |
| 32499 | 1023 |
| 32500 | 1023 |
| 32501 | 1023 |
| 32502 | 0 |
| 32503 | 0 |
| 32504 | 0 |
| 32505 | 0 |
| 32506 | 0 |
| 32507 | 0 |
| 32508 | 0 |
| 32509 | 0 |
| 32510 | 0 |
| 32511 | 0 |
| 32512 | 0 |
| 32513 | 0 |
| 32514 | 0 |
| 32515 | 0 |
| 32516 | 1023 |
| 32517 | 1023 |
| 32518 | 1023 |
| 32519 | 1023 |
| 32520 | 1023 |
| 32521 | 1023 |
| 32522 | 1023 |
| 32523 | 1023 |
| 32524 | 1023 |
| 32525 | 1023 |
| 32526 | 1023 |
| 32527 | 1023 |
| 32528 | 1023 |
| 32529 | 1023 |
| 32530 | 1023 |
| 32531 | 1023 |
| 32532 | 1023 |
| 32533 | 1023 |
| 32534 | 1023 |
| 32535 | 1023 |
| 32536 | 1023 |
| 32537 | 1023 |
| 32538 | 1023 |
| 32539 | 1023 |
| 32540 | 1023 |
| 32541 | 1023 |
| 32542 | 1023 |
| 32543 | 1023 |
| 32544 | 1023 |
| 32545 | 1023 |
| 32546 | 1023 |
| 32547 | 1023 |
| 32548 | 1023 |
| 32549 | 1023 |
| 32550 | 1023 |
| 32551 | 1023 |
| 32552 | 1023 |
| 32553 | 1023 |
| 32554 | 1 |
| 32555 | 0 |
| 32556 | 0 |
| 32557 | 0 |
| 32558 | 0 |
| 32559 | 0 |
| 32560 | 0 |
| 32561 | 0 |
| 32562 | 0 |
| 32563 | 0 |
| 32564 | 0 |
| 32565 | 0 |
| 32566 | 0 |
| 32567 | 0 |
| 32568 | 1023 |
| 32569 | 1023 |
| 32570 | 1023 |
| 32571 | 1023 |
| 32572 | 1023 |
| 32573 | 1023 |
| 32574 | 1023 |
| 32575 | 1023 |
| 32576 | 1023 |
| 32577 | 1023 |
| 32578 | 1023 |
| 32579 | 1023 |
| 32580 | 1023 |
| 32581 | 1023 |
| 32582 | 1023 |
| 32583 | 1023 |
| 32584 | 1023 |
| 32585 | 1023 |
| 32586 | 1023 |
| 32587 | 1023 |
| 32588 | 1023 |
| 32589 | 1023 |
| 32590 | 1023 |
| 32591 | 1023 |
| 32592 | 1023 |
| 32593 | 1023 |
| 32594 | 1023 |
| 32595 | 1023 |
| 32596 | 1023 |
| 32597 | 1023 |
| 32598 | 1023 |
| 32599 | 1023 |
| 32600 | 1023 |
| 32601 | 1023 |
| 32602 | 1023 |
| 32603 | 1023 |
| 32604 | 1023 |
| 32605 | 0 |
| 32606 | 0 |
| 32607 | 0 |
| 32608 | 0 |
| 32609 | 0 |
| 32610 | 0 |
| 32611 | 0 |
| 32612 | 0 |
| 32613 | 0 |
| 32614 | 0 |
| 32615 | 0 |
| 32616 | 0 |
| 32617 | 0 |
| 32618 | 0 |
| 32619 | 0 |
| 32620 | 1023 |
| 32621 | 1023 |
| 32622 | 1023 |
| 32623 | 1023 |
| 32624 | 1023 |
| 32625 | 1023 |
| 32626 | 1023 |
| 32627 | 1023 |
| 32628 | 1023 |
| 32629 | 1023 |
| 32630 | 1023 |
| 32631 | 1023 |
| 32632 | 1023 |
| 32633 | 1023 |
| 32634 | 1023 |
| 32635 | 1023 |
| 32636 | 1023 |
| 32637 | 1023 |
| 32638 | 1023 |
| 32639 | 1023 |
| 32640 | 1023 |
| 32641 | 1023 |
| 32642 | 1023 |
| 32643 | 1023 |
| 32644 | 1023 |
| 32645 | 1023 |
| 32646 | 1023 |
| 32647 | 1023 |
| 32648 | 1023 |
| 32649 | 1023 |
| 32650 | 1023 |
| 32651 | 1023 |
| 32652 | 1023 |
| 32653 | 1023 |
| 32654 | 1023 |
| 32655 | 1023 |
| 32656 | 1023 |
| 32657 | 0 |
| 32658 | 0 |
| 32659 | 0 |
| 32660 | 0 |
| 32661 | 0 |
| 32662 | 0 |
| 32663 | 0 |
| 32664 | 0 |
| 32665 | 0 |
| 32666 | 0 |
| 32667 | 0 |
| 32668 | 0 |
| 32669 | 0 |
| 32670 | 0 |
| 32671 | 0 |
| 32672 | 1023 |
| 32673 | 1023 |
| 32674 | 1023 |
| 32675 | 1023 |
| 32676 | 1023 |
| 32677 | 1023 |
| 32678 | 1023 |
| 32679 | 1023 |
| 32680 | 1023 |
| 32681 | 1023 |
| 32682 | 1023 |
| 32683 | 1023 |
| 32684 | 1023 |
| 32685 | 1023 |
| 32686 | 1023 |
| 32687 | 1023 |
| 32688 | 1023 |
| 32689 | 1023 |
| 32690 | 1023 |
| 32691 | 1023 |
| 32692 | 1023 |
| 32693 | 1023 |
| 32694 | 1023 |
| 32695 | 1023 |
| 32696 | 1023 |
| 32697 | 1023 |
| 32698 | 1023 |
| 32699 | 1023 |
| 32700 | 1023 |
| 32701 | 1023 |
| 32702 | 1023 |
| 32703 | 1023 |
| 32704 | 1023 |
| 32705 | 1023 |
| 32706 | 1023 |
| 32707 | 1023 |
| 32708 | 1023 |
| 32709 | 0 |
| 32710 | 0 |
| 32711 | 0 |
| 32712 | 0 |
| 32713 | 0 |
| 32714 | 0 |
| 32715 | 0 |
| 32716 | 0 |
| 32717 | 0 |
| 32718 | 0 |
| 32719 | 0 |
| 32720 | 0 |
| 32721 | 0 |
| 32722 | 0 |
| 32723 | 0 |
| 32724 | 1023 |
| 32725 | 1023 |
| 32726 | 1023 |
| 32727 | 1023 |
| 32728 | 1023 |
| 32729 | 1023 |
| 32730 | 1023 |
| 32731 | 1023 |
| 32732 | 1023 |
| 32733 | 1023 |
| 32734 | 1023 |
| 32735 | 1023 |
| 32736 | 1023 |
| 32737 | 1023 |
| 32738 | 1023 |
| 32739 | 1023 |
| 32740 | 1023 |
| 32741 | 1023 |
| 32742 | 1023 |
| 32743 | 1023 |
| 32744 | 1023 |
| 32745 | 1023 |
| 32746 | 1023 |
| 32747 | 1023 |
| 32748 | 1023 |
| 32749 | 1023 |
| 32750 | 1023 |
| 32751 | 1023 |
| 32752 | 1023 |
| 32753 | 1023 |
| 32754 | 1023 |
| 32755 | 1023 |
| 32756 | 1023 |
| 32757 | 1023 |
| 32758 | 1023 |
| 32759 | 1023 |
| 32760 | 1023 |
| 32761 | 1023 |
| 32762 | 0 |
| 32763 | 0 |
| 32764 | 0 |
| 32765 | 0 |
| 32766 | 0 |
| 32767 | 0 |
| 32768 | 0 |
| 32769 | 0 |
| 32770 | 0 |
| 32771 | 0 |
| 32772 | 0 |
| 32773 | 0 |
| 32774 | 0 |
| 32775 | 1023 |
| 32776 | 1023 |
| 32777 | 1023 |
| 32778 | 1023 |
| 32779 | 1023 |
| 32780 | 1023 |
| 32781 | 1023 |
| 32782 | 1023 |
| 32783 | 1023 |
| 32784 | 1023 |
| 32785 | 1023 |
| 32786 | 1023 |
| 32787 | 1023 |
| 32788 | 1023 |
| 32789 | 1023 |
| 32790 | 1023 |
| 32791 | 1023 |
| 32792 | 1023 |
| 32793 | 1023 |
| 32794 | 1023 |
| 32795 | 1023 |
| 32796 | 1023 |
| 32797 | 1023 |
| 32798 | 1023 |
| 32799 | 1023 |
| 32800 | 1023 |
| 32801 | 1023 |
| 32802 | 1023 |
| 32803 | 1023 |
| 32804 | 1023 |
| 32805 | 1023 |
| 32806 | 1023 |
| 32807 | 1023 |
| 32808 | 1023 |
| 32809 | 1023 |
| 32810 | 1023 |
| 32811 | 1023 |
| 32812 | 1023 |
| 32813 | 0 |
| 32814 | 0 |
| 32815 | 0 |
| 32816 | 0 |
| 32817 | 0 |
| 32818 | 1 |
| 32819 | 0 |
| 32820 | 0 |
| 32821 | 0 |
| 32822 | 0 |
| 32823 | 0 |
| 32824 | 1 |
| 32825 | 0 |
| 32826 | 1023 |
| 32827 | 1023 |
| 32828 | 1023 |
| 32829 | 1023 |
| 32830 | 1023 |
| 32831 | 1023 |
| 32832 | 1023 |
| 32833 | 1023 |
| 32834 | 1023 |
| 32835 | 1023 |
| 32836 | 1023 |
| 32837 | 1023 |
| 32838 | 1023 |
| 32839 | 1023 |
| 32840 | 1023 |
| 32841 | 1023 |
| 32842 | 1023 |
| 32843 | 1023 |
| 32844 | 1023 |
| 32845 | 1023 |
| 32846 | 1023 |
| 32847 | 1023 |
| 32848 | 1023 |
| 32849 | 1023 |
| 32850 | 1023 |
| 32851 | 1023 |
| 32852 | 1023 |
| 32853 | 1023 |
| 32854 | 1023 |
| 32855 | 1023 |
| 32856 | 1023 |
| 32857 | 1023 |
| 32858 | 1023 |
| 32859 | 1023 |
| 32860 | 1023 |
| 32861 | 1023 |
| 32862 | 1023 |
| 32863 | 1023 |
| 32864 | 0 |
| 32865 | 0 |
| 32866 | 0 |
| 32867 | 0 |
| 32868 | 0 |
| 32869 | 0 |
| 32870 | 0 |
| 32871 | 0 |
| 32872 | 0 |
| 32873 | 0 |
| 32874 | 0 |
| 32875 | 0 |
| 32876 | 0 |
| 32877 | 1023 |
| 32878 | 1023 |
| 32879 | 1023 |
| 32880 | 1023 |
| 32881 | 1023 |
| 32882 | 1023 |
| 32883 | 1023 |
| 32884 | 1023 |
| 32885 | 1023 |
| 32886 | 1023 |
| 32887 | 1023 |
| 32888 | 1023 |
| 32889 | 1023 |
| 32890 | 1023 |
| 32891 | 1023 |
| 32892 | 1023 |
| 32893 | 1023 |
| 32894 | 1023 |
| 32895 | 1023 |
| 32896 | 1023 |
| 32897 | 1023 |
| 32898 | 1023 |
| 32899 | 1023 |
| 32900 | 1023 |
| 32901 | 1023 |
| 32902 | 1023 |
| 32903 | 1023 |
| 32904 | 1023 |
| 32905 | 1023 |
| 32906 | 1023 |
| 32907 | 1023 |
| 32908 | 1023 |
| 32909 | 1023 |
| 32910 | 1023 |
| 32911 | 1023 |
| 32912 | 1023 |
| 32913 | 1023 |
| 32914 | 1023 |
| 32915 | 0 |
| 32916 | 0 |
| 32917 | 0 |
| 32918 | 0 |
| 32919 | 0 |
| 32920 | 0 |
| 32921 | 0 |
| 32922 | 0 |
| 32923 | 0 |
| 32924 | 0 |
| 32925 | 0 |
| 32926 | 0 |
| 32927 | 0 |
| 32928 | 1023 |
| 32929 | 1023 |
| 32930 | 1023 |
| 32931 | 1023 |
| 32932 | 1023 |
| 32933 | 1023 |
| 32934 | 1023 |
| 32935 | 1023 |
| 32936 | 1023 |
| 32937 | 1023 |
| 32938 | 1023 |
| 32939 | 1023 |
| 32940 | 1023 |
| 32941 | 1023 |
| 32942 | 1023 |
| 32943 | 1023 |
| 32944 | 1023 |
| 32945 | 1023 |
| 32946 | 1023 |
| 32947 | 1023 |
| 32948 | 1023 |
| 32949 | 1023 |
| 32950 | 1023 |
| 32951 | 1023 |
| 32952 | 1023 |
| 32953 | 1023 |
| 32954 | 1023 |
| 32955 | 1023 |
| 32956 | 1023 |
| 32957 | 1023 |
| 32958 | 1023 |
| 32959 | 1023 |
| 32960 | 1023 |
| 32961 | 1023 |
| 32962 | 1023 |
| 32963 | 1023 |
| 32964 | 1023 |
| 32965 | 1023 |
| 32966 | 0 |
| 32967 | 0 |
| 32968 | 0 |
| 32969 | 1 |
| 32970 | 0 |
| 32971 | 0 |
| 32972 | 0 |
| 32973 | 0 |
| 32974 | 0 |
| 32975 | 0 |
| 32976 | 0 |
| 32977 | 0 |
| 32978 | 0 |
| 32979 | 1023 |
| 32980 | 1023 |
| 32981 | 1023 |
| 32982 | 1023 |
| 32983 | 1023 |
| 32984 | 1023 |
| 32985 | 1023 |
| 32986 | 1023 |
| 32987 | 1023 |
| 32988 | 1023 |
| 32989 | 1023 |
| 32990 | 1023 |
| 32991 | 1023 |
| 32992 | 1023 |
| 32993 | 1023 |
| 32994 | 1023 |
| 32995 | 1023 |
| 32996 | 1023 |
| 32997 | 1023 |
| 32998 | 1023 |
| 32999 | 1023 |
| 33000 | 1023 |
| 33001 | 1023 |
| 33002 | 1023 |
| 33003 | 1023 |
| 33004 | 1023 |
| 33005 | 1023 |
| 33006 | 1023 |
| 33007 | 1023 |
| 33008 | 1023 |
| 33009 | 1023 |
| 33010 | 1023 |
| 33011 | 1023 |
| 33012 | 1023 |
| 33013 | 1023 |
| 33014 | 1023 |
| 33015 | 1023 |
| 33016 | 1023 |
| 33017 | 0 |
| 33018 | 0 |
| 33019 | 0 |
| 33020 | 0 |
| 33021 | 0 |
| 33022 | 0 |
| 33023 | 0 |
| 33024 | 0 |
| 33025 | 0 |
| 33026 | 0 |
| 33027 | 0 |
| 33028 | 0 |
| 33029 | 0 |
| 33030 | 1023 |
| 33031 | 1023 |
| 33032 | 1023 |
| 33033 | 1023 |
| 33034 | 1023 |
| 33035 | 1023 |
| 33036 | 1023 |
| 33037 | 1023 |
| 33038 | 1023 |
| 33039 | 1023 |
| 33040 | 1023 |
| 33041 | 1023 |
| 33042 | 1023 |
| 33043 | 1023 |
| 33044 | 1023 |
| 33045 | 1023 |
| 33046 | 1023 |
| 33047 | 1023 |
| 33048 | 1023 |
| 33049 | 1023 |
| 33050 | 1023 |
| 33051 | 1023 |
| 33052 | 1023 |
| 33053 | 1023 |
| 33054 | 1023 |
| 33055 | 1023 |
| 33056 | 1023 |
| 33057 | 1023 |
| 33058 | 1023 |
| 33059 | 1023 |
| 33060 | 1023 |
| 33061 | 1023 |
| 33062 | 1023 |
| 33063 | 1023 |
| 33064 | 1023 |
| 33065 | 1023 |
| 33066 | 1023 |
| 33067 | 1023 |
| 33068 | 0 |
| 33069 | 0 |
| 33070 | 0 |
| 33071 | 0 |
| 33072 | 0 |
| 33073 | 0 |
| 33074 | 0 |
| 33075 | 0 |
| 33076 | 0 |
| 33077 | 0 |
| 33078 | 0 |
| 33079 | 0 |
| 33080 | 0 |
| 33081 | 1023 |
| 33082 | 1023 |
| 33083 | 1023 |
| 33084 | 1023 |
| 33085 | 1023 |
| 33086 | 1023 |
| 33087 | 1023 |
| 33088 | 1023 |
| 33089 | 1023 |
| 33090 | 1023 |
| 33091 | 1023 |
| 33092 | 1023 |
| 33093 | 1023 |
| 33094 | 1023 |
| 33095 | 1023 |
| 33096 | 1023 |
| 33097 | 1023 |
| 33098 | 1023 |
| 33099 | 1023 |
| 33100 | 1023 |
| 33101 | 1023 |
| 33102 | 1023 |
| 33103 | 1023 |
| 33104 | 1023 |
| 33105 | 1023 |
| 33106 | 1023 |
| 33107 | 1023 |
| 33108 | 1023 |
| 33109 | 1023 |
| 33110 | 1023 |
| 33111 | 1023 |
| 33112 | 1023 |
| 33113 | 1023 |
| 33114 | 1023 |
| 33115 | 1023 |
| 33116 | 1023 |
| 33117 | 1023 |
| 33118 | 1023 |
| 33119 | 0 |
| 33120 | 0 |
| 33121 | 0 |
| 33122 | 0 |
| 33123 | 0 |
| 33124 | 0 |
| 33125 | 0 |
| 33126 | 0 |
| 33127 | 0 |
| 33128 | 0 |
| 33129 | 0 |
| 33130 | 0 |
| 33131 | 0 |
| 33132 | 0 |
| 33133 | 1023 |
| 33134 | 1023 |
| 33135 | 1023 |
| 33136 | 1023 |
| 33137 | 1023 |
| 33138 | 1023 |
| 33139 | 1023 |
| 33140 | 1023 |
| 33141 | 1023 |
| 33142 | 1023 |
| 33143 | 1023 |
| 33144 | 1023 |
| 33145 | 1023 |
| 33146 | 1023 |
| 33147 | 1023 |
| 33148 | 1023 |
| 33149 | 1023 |
| 33150 | 1023 |
| 33151 | 1023 |
| 33152 | 1023 |
| 33153 | 1023 |
| 33154 | 1023 |
| 33155 | 1023 |
| 33156 | 1023 |
| 33157 | 1023 |
| 33158 | 1023 |
| 33159 | 1023 |
| 33160 | 1023 |
| 33161 | 1023 |
| 33162 | 1023 |
| 33163 | 1023 |
| 33164 | 1023 |
| 33165 | 1023 |
| 33166 | 1023 |
| 33167 | 1023 |
| 33168 | 1023 |
| 33169 | 1023 |
| 33170 | 0 |
| 33171 | 0 |
| 33172 | 0 |
| 33173 | 0 |
| 33174 | 0 |
| 33175 | 0 |
| 33176 | 0 |
| 33177 | 0 |
| 33178 | 0 |
| 33179 | 0 |
| 33180 | 0 |
| 33181 | 0 |
| 33182 | 0 |
| 33183 | 0 |
| 33184 | 0 |
| 33185 | 1023 |
| 33186 | 1023 |
| 33187 | 1023 |
| 33188 | 1023 |
| 33189 | 1023 |
| 33190 | 1023 |
| 33191 | 1023 |
| 33192 | 1023 |
| 33193 | 1023 |
| 33194 | 1023 |
| 33195 | 1023 |
| 33196 | 1023 |
| 33197 | 1023 |
| 33198 | 1023 |
| 33199 | 1023 |
| 33200 | 1023 |
| 33201 | 1023 |
| 33202 | 1023 |
| 33203 | 1023 |
| 33204 | 1023 |
| 33205 | 1023 |
| 33206 | 1023 |
| 33207 | 1023 |
| 33208 | 1023 |
| 33209 | 1023 |
| 33210 | 1023 |
| 33211 | 1023 |
| 33212 | 1023 |
| 33213 | 1023 |
| 33214 | 1023 |
| 33215 | 1023 |
| 33216 | 1023 |
| 33217 | 1023 |
| 33218 | 1023 |
| 33219 | 1023 |
| 33220 | 1023 |
| 33221 | 1023 |
| 33222 | 0 |
| 33223 | 0 |
| 33224 | 0 |
| 33225 | 0 |
| 33226 | 0 |
| 33227 | 0 |
| 33228 | 0 |
| 33229 | 0 |
| 33230 | 0 |
| 33231 | 0 |
| 33232 | 0 |
| 33233 | 0 |
| 33234 | 0 |
| 33235 | 0 |
| 33236 | 0 |
| 33237 | 1023 |
| 33238 | 1023 |
| 33239 | 1023 |
| 33240 | 1023 |
| 33241 | 1023 |
| 33242 | 1023 |
| 33243 | 1023 |
| 33244 | 1023 |
| 33245 | 1023 |
| 33246 | 1023 |
| 33247 | 1023 |
| 33248 | 1023 |
| 33249 | 1023 |
| 33250 | 1023 |
| 33251 | 1023 |
| 33252 | 1023 |
| 33253 | 1023 |
| 33254 | 1023 |
| 33255 | 1023 |
| 33256 | 1023 |
| 33257 | 1023 |
| 33258 | 1023 |
| 33259 | 1023 |
| 33260 | 1023 |
| 33261 | 1023 |
| 33262 | 1023 |
| 33263 | 1023 |
| 33264 | 1023 |
| 33265 | 1023 |
| 33266 | 1023 |
| 33267 | 1023 |
| 33268 | 1023 |
| 33269 | 1023 |
| 33270 | 1023 |
| 33271 | 1023 |
| 33272 | 1023 |
| 33273 | 1023 |
| 33274 | 0 |
| 33275 | 0 |
| 33276 | 0 |
| 33277 | 0 |
| 33278 | 0 |
| 33279 | 0 |
| 33280 | 0 |
| 33281 | 0 |
| 33282 | 0 |
| 33283 | 0 |
| 33284 | 0 |
| 33285 | 0 |
| 33286 | 0 |
| 33287 | 0 |
| 33288 | 0 |
| 33289 | 1023 |
| 33290 | 1023 |
| 33291 | 1023 |
| 33292 | 1023 |
| 33293 | 1023 |
| 33294 | 1023 |
| 33295 | 1023 |
| 33296 | 1023 |
| 33297 | 1023 |
| 33298 | 1023 |
| 33299 | 1023 |
| 33300 | 1023 |
| 33301 | 1023 |
| 33302 | 1023 |
| 33303 | 1023 |
| 33304 | 1023 |
| 33305 | 1023 |
| 33306 | 1023 |
| 33307 | 1023 |
| 33308 | 1023 |
| 33309 | 1023 |
| 33310 | 1023 |
| 33311 | 1023 |
| 33312 | 1023 |
| 33313 | 1023 |
| 33314 | 1023 |
| 33315 | 1023 |
| 33316 | 1023 |
| 33317 | 1023 |
| 33318 | 1023 |
| 33319 | 1023 |
| 33320 | 1023 |
| 33321 | 1023 |
| 33322 | 1023 |
| 33323 | 1023 |
| 33324 | 1023 |
| 33325 | 1023 |
| 33326 | 1023 |
| 33327 | 0 |
| 33328 | 0 |
| 33329 | 0 |
| 33330 | 0 |
| 33331 | 0 |
| 33332 | 0 |
| 33333 | 0 |
| 33334 | 0 |
| 33335 | 0 |
| 33336 | 0 |
| 33337 | 0 |
| 33338 | 0 |
| 33339 | 0 |
| 33340 | 1023 |
| 33341 | 1023 |
| 33342 | 1023 |
| 33343 | 1023 |
| 33344 | 1023 |
| 33345 | 1023 |
| 33346 | 1023 |
| 33347 | 1023 |
| 33348 | 1023 |
| 33349 | 1023 |
| 33350 | 1023 |
| 33351 | 1023 |
| 33352 | 1023 |
| 33353 | 1023 |
| 33354 | 1023 |
| 33355 | 1023 |
| 33356 | 1023 |
| 33357 | 1023 |
| 33358 | 1023 |
| 33359 | 1023 |
| 33360 | 1023 |
| 33361 | 1023 |
| 33362 | 1023 |
| 33363 | 1023 |
| 33364 | 1023 |
| 33365 | 1023 |
| 33366 | 1023 |
| 33367 | 1023 |
| 33368 | 1023 |
| 33369 | 1023 |
| 33370 | 1023 |
| 33371 | 1023 |
| 33372 | 1023 |
| 33373 | 1023 |
| 33374 | 1023 |
| 33375 | 1023 |
| 33376 | 1023 |
| 33377 | 1023 |
| 33378 | 0 |
| 33379 | 0 |
| 33380 | 0 |
| 33381 | 0 |
| 33382 | 0 |
| 33383 | 0 |
| 33384 | 0 |
| 33385 | 0 |
| 33386 | 0 |
| 33387 | 0 |
| 33388 | 0 |
| 33389 | 0 |
| 33390 | 0 |
| 33391 | 1023 |
| 33392 | 1023 |
| 33393 | 1023 |
| 33394 | 1023 |
| 33395 | 1023 |
| 33396 | 1023 |
| 33397 | 1023 |
| 33398 | 1023 |
| 33399 | 1023 |
| 33400 | 1023 |
| 33401 | 1023 |
| 33402 | 1023 |
| 33403 | 1023 |
| 33404 | 1023 |
| 33405 | 1023 |
| 33406 | 1023 |
| 33407 | 1023 |
| 33408 | 1023 |
| 33409 | 1023 |
| 33410 | 1023 |
| 33411 | 1023 |
| 33412 | 1023 |
| 33413 | 1023 |
| 33414 | 1023 |
| 33415 | 1023 |
| 33416 | 1023 |
| 33417 | 1023 |
| 33418 | 1023 |
| 33419 | 1023 |
| 33420 | 1023 |
| 33421 | 1023 |
| 33422 | 1023 |
| 33423 | 1023 |
| 33424 | 1023 |
| 33425 | 1023 |
| 33426 | 1023 |
| 33427 | 1023 |
| 33428 | 1023 |
| 33429 | 0 |
| 33430 | 0 |
| 33431 | 0 |
| 33432 | 0 |
| 33433 | 0 |
| 33434 | 0 |
| 33435 | 0 |
| 33436 | 0 |
| 33437 | 0 |
| 33438 | 0 |
| 33439 | 0 |
| 33440 | 0 |
| 33441 | 0 |
| 33442 | 1023 |
| 33443 | 1023 |
| 33444 | 1023 |
| 33445 | 1023 |
| 33446 | 1023 |
| 33447 | 1023 |
| 33448 | 1023 |
| 33449 | 1023 |
| 33450 | 1023 |
| 33451 | 1023 |
| 33452 | 1023 |
| 33453 | 1023 |
| 33454 | 1023 |
| 33455 | 1023 |
| 33456 | 1023 |
| 33457 | 1023 |
| 33458 | 1023 |
| 33459 | 1023 |
| 33460 | 1023 |
| 33461 | 1023 |
| 33462 | 1023 |
| 33463 | 1023 |
| 33464 | 1023 |
| 33465 | 1023 |
| 33466 | 1023 |
| 33467 | 1023 |
| 33468 | 1023 |
| 33469 | 1023 |
| 33470 | 1023 |
| 33471 | 1023 |
| 33472 | 1023 |
| 33473 | 1023 |
| 33474 | 1023 |
| 33475 | 1023 |
| 33476 | 1023 |
| 33477 | 1023 |
| 33478 | 1023 |
| 33479 | 1023 |
| 33480 | 0 |
| 33481 | 0 |
| 33482 | 0 |
| 33483 | 0 |
| 33484 | 0 |
| 33485 | 0 |
| 33486 | 1 |
| 33487 | 0 |
| 33488 | 0 |
| 33489 | 0 |
| 33490 | 0 |
| 33491 | 0 |
| 33492 | 0 |
| 33493 | 1023 |
| 33494 | 1023 |
| 33495 | 1023 |
| 33496 | 1023 |
| 33497 | 1023 |
| 33498 | 1023 |
| 33499 | 1023 |
| 33500 | 1023 |
| 33501 | 1023 |
| 33502 | 1023 |
| 33503 | 1023 |
| 33504 | 1023 |
| 33505 | 1023 |
| 33506 | 1023 |
| 33507 | 1023 |
| 33508 | 1023 |
| 33509 | 1023 |
| 33510 | 1023 |
| 33511 | 1023 |
| 33512 | 1023 |
| 33513 | 1023 |
| 33514 | 1023 |
| 33515 | 1023 |
| 33516 | 1023 |
| 33517 | 1023 |
| 33518 | 1023 |
| 33519 | 1023 |
| 33520 | 1023 |
| 33521 | 1023 |
| 33522 | 1023 |
| 33523 | 1023 |
| 33524 | 1023 |
| 33525 | 1023 |
| 33526 | 1023 |
| 33527 | 1023 |
| 33528 | 1023 |
| 33529 | 1023 |
| 33530 | 1023 |
| 33531 | 0 |
| 33532 | 0 |
| 33533 | 0 |
| 33534 | 0 |
| 33535 | 0 |
| 33536 | 0 |
| 33537 | 0 |
| 33538 | 0 |
| 33539 | 0 |
| 33540 | 0 |
| 33541 | 0 |
| 33542 | 0 |
| 33543 | 0 |
| 33544 | 1023 |
| 33545 | 1023 |
| 33546 | 1023 |
| 33547 | 1023 |
| 33548 | 1023 |
| 33549 | 1023 |
| 33550 | 1023 |
| 33551 | 1023 |
| 33552 | 1023 |
| 33553 | 1023 |
| 33554 | 1023 |
| 33555 | 1023 |
| 33556 | 1023 |
| 33557 | 1023 |
| 33558 | 1023 |
| 33559 | 1023 |
| 33560 | 1023 |
| 33561 | 1023 |
| 33562 | 1023 |
| 33563 | 1023 |
| 33564 | 1023 |
| 33565 | 1023 |
| 33566 | 1023 |
| 33567 | 1023 |
| 33568 | 1023 |
| 33569 | 1023 |
| 33570 | 1023 |
| 33571 | 1023 |
| 33572 | 1023 |
| 33573 | 1023 |
| 33574 | 1023 |
| 33575 | 1023 |
| 33576 | 1023 |
| 33577 | 1023 |
| 33578 | 1023 |
| 33579 | 1023 |
| 33580 | 1023 |
| 33581 | 1023 |
| 33582 | 0 |
| 33583 | 0 |
| 33584 | 0 |
| 33585 | 0 |
| 33586 | 0 |
| 33587 | 0 |
| 33588 | 0 |
| 33589 | 0 |
| 33590 | 0 |
| 33591 | 0 |
| 33592 | 0 |
| 33593 | 0 |
| 33594 | 0 |
| 33595 | 1023 |
| 33596 | 1023 |
| 33597 | 1023 |
| 33598 | 1023 |
| 33599 | 1023 |
| 33600 | 1023 |
| 33601 | 1023 |
| 33602 | 1023 |
| 33603 | 1023 |
| 33604 | 1023 |
| 33605 | 1023 |
| 33606 | 1023 |
| 33607 | 1023 |
| 33608 | 1023 |
| 33609 | 1023 |
| 33610 | 1023 |
| 33611 | 1023 |
| 33612 | 1023 |
| 33613 | 1023 |
| 33614 | 1023 |
| 33615 | 1023 |
| 33616 | 1023 |
| 33617 | 1023 |
| 33618 | 1023 |
| 33619 | 1023 |
| 33620 | 1023 |
| 33621 | 1023 |
| 33622 | 1023 |
| 33623 | 1023 |
| 33624 | 1023 |
| 33625 | 1023 |
| 33626 | 1023 |
| 33627 | 1023 |
| 33628 | 1023 |
| 33629 | 1023 |
| 33630 | 1023 |
| 33631 | 1023 |
| 33632 | 1023 |
| 33633 | 0 |
| 33634 | 0 |
| 33635 | 0 |
| 33636 | 0 |
| 33637 | 0 |
| 33638 | 0 |
| 33639 | 0 |
| 33640 | 0 |
| 33641 | 0 |
| 33642 | 0 |
| 33643 | 0 |
| 33644 | 0 |
| 33645 | 0 |
| 33646 | 1023 |
| 33647 | 1023 |
| 33648 | 1023 |
| 33649 | 1023 |
| 33650 | 1023 |
| 33651 | 1023 |
| 33652 | 1023 |
| 33653 | 1023 |
| 33654 | 1023 |
| 33655 | 1023 |
| 33656 | 1023 |
| 33657 | 1023 |
| 33658 | 1023 |
| 33659 | 1023 |
| 33660 | 1023 |
| 33661 | 1023 |
| 33662 | 1023 |
| 33663 | 1023 |
| 33664 | 1023 |
| 33665 | 1023 |
| 33666 | 1023 |
| 33667 | 1023 |
| 33668 | 1023 |
| 33669 | 1023 |
| 33670 | 1023 |
| 33671 | 1023 |
| 33672 | 1023 |
| 33673 | 1023 |
| 33674 | 1023 |
| 33675 | 1023 |
| 33676 | 1023 |
| 33677 | 1023 |
| 33678 | 1023 |
| 33679 | 1023 |
| 33680 | 1023 |
| 33681 | 1023 |
| 33682 | 1023 |
| 33683 | 1023 |
| 33684 | 0 |
| 33685 | 0 |
| 33686 | 0 |
| 33687 | 0 |
| 33688 | 0 |
| 33689 | 0 |
| 33690 | 0 |
| 33691 | 0 |
| 33692 | 0 |
| 33693 | 0 |
| 33694 | 0 |
| 33695 | 0 |
| 33696 | 0 |
| 33697 | 0 |
| 33698 | 1023 |
| 33699 | 1023 |
| 33700 | 1023 |
| 33701 | 1023 |
| 33702 | 1023 |
| 33703 | 1023 |
| 33704 | 1023 |
| 33705 | 1023 |
| 33706 | 1023 |
| 33707 | 1023 |
| 33708 | 1023 |
| 33709 | 1023 |
| 33710 | 1023 |
| 33711 | 1023 |
| 33712 | 1023 |
| 33713 | 1023 |
| 33714 | 1023 |
| 33715 | 1023 |
| 33716 | 1023 |
| 33717 | 1023 |
| 33718 | 1023 |
| 33719 | 1023 |
| 33720 | 1023 |
| 33721 | 1023 |
| 33722 | 1023 |
| 33723 | 1023 |
| 33724 | 1023 |
| 33725 | 1023 |
| 33726 | 1023 |
| 33727 | 1023 |
| 33728 | 1023 |
| 33729 | 1023 |
| 33730 | 1023 |
| 33731 | 1023 |
| 33732 | 1023 |
| 33733 | 1023 |
| 33734 | 1023 |
| 33735 | 0 |
| 33736 | 0 |
| 33737 | 0 |
| 33738 | 0 |
| 33739 | 0 |
| 33740 | 0 |
| 33741 | 0 |
| 33742 | 0 |
| 33743 | 0 |
| 33744 | 0 |
| 33745 | 0 |
| 33746 | 0 |
| 33747 | 0 |
| 33748 | 0 |
| 33749 | 726 |
| 33750 | 1023 |
| 33751 | 1023 |
| 33752 | 1023 |
| 33753 | 1023 |
| 33754 | 1023 |
| 33755 | 1023 |
| 33756 | 1023 |
| 33757 | 1023 |
| 33758 | 1023 |
| 33759 | 1023 |
| 33760 | 1023 |
| 33761 | 1023 |
| 33762 | 1023 |
| 33763 | 1023 |
| 33764 | 1023 |
| 33765 | 1023 |
| 33766 | 1023 |
| 33767 | 1023 |
| 33768 | 1023 |
| 33769 | 1023 |
| 33770 | 1023 |
| 33771 | 1023 |
| 33772 | 1023 |
| 33773 | 1023 |
| 33774 | 1023 |
| 33775 | 1023 |
| 33776 | 1023 |
| 33777 | 1023 |
| 33778 | 1023 |
| 33779 | 1023 |
| 33780 | 1023 |
| 33781 | 1023 |
| 33782 | 1023 |
| 33783 | 1023 |
| 33784 | 1023 |
| 33785 | 1023 |
| 33786 | 1023 |
| 33787 | 0 |
| 33788 | 0 |
| 33789 | 0 |
| 33790 | 0 |
| 33791 | 0 |
| 33792 | 0 |
| 33793 | 0 |
| 33794 | 0 |
| 33795 | 0 |
| 33796 | 0 |
| 33797 | 0 |
| 33798 | 0 |
| 33799 | 0 |
| 33800 | 0 |
| 33801 | 1023 |
| 33802 | 1023 |
| 33803 | 1023 |
| 33804 | 1023 |
| 33805 | 1023 |
| 33806 | 1023 |
| 33807 | 1023 |
| 33808 | 1023 |
| 33809 | 1023 |
| 33810 | 1023 |
| 33811 | 1023 |
| 33812 | 1023 |
| 33813 | 1023 |
| 33814 | 1023 |
| 33815 | 1023 |
| 33816 | 1023 |
| 33817 | 1023 |
| 33818 | 1023 |
| 33819 | 1023 |
| 33820 | 1023 |
| 33821 | 1023 |
| 33822 | 1023 |
| 33823 | 1023 |
| 33824 | 1023 |
| 33825 | 1023 |
| 33826 | 1023 |
| 33827 | 1023 |
| 33828 | 1023 |
| 33829 | 1023 |
| 33830 | 1023 |
| 33831 | 1023 |
| 33832 | 1023 |
| 33833 | 1023 |
| 33834 | 1023 |
| 33835 | 1023 |
| 33836 | 1023 |
| 33837 | 1023 |
| 33838 | 1023 |
| 33839 | 0 |
| 33840 | 0 |
| 33841 | 0 |
| 33842 | 0 |
| 33843 | 0 |
| 33844 | 0 |
| 33845 | 0 |
| 33846 | 0 |
| 33847 | 0 |
| 33848 | 1 |
| 33849 | 0 |
| 33850 | 0 |
| 33851 | 0 |
| 33852 | 1023 |
| 33853 | 1023 |
| 33854 | 1023 |
| 33855 | 1023 |
| 33856 | 1023 |
| 33857 | 1023 |
| 33858 | 1023 |
| 33859 | 1023 |
| 33860 | 1023 |
| 33861 | 1023 |
| 33862 | 1023 |
| 33863 | 1023 |
| 33864 | 1023 |
| 33865 | 1023 |
| 33866 | 1023 |
| 33867 | 1023 |
| 33868 | 1023 |
| 33869 | 1023 |
| 33870 | 1023 |
| 33871 | 1023 |
| 33872 | 1023 |
| 33873 | 1023 |
| 33874 | 1023 |
| 33875 | 1023 |
| 33876 | 1023 |
| 33877 | 1023 |
| 33878 | 1023 |
| 33879 | 1023 |
| 33880 | 1023 |
| 33881 | 1023 |
| 33882 | 1023 |
| 33883 | 1023 |
| 33884 | 1023 |
| 33885 | 1023 |
| 33886 | 1023 |
| 33887 | 1023 |
| 33888 | 1023 |
| 33889 | 1023 |
| 33890 | 0 |
| 33891 | 0 |
| 33892 | 0 |
| 33893 | 0 |
| 33894 | 0 |
| 33895 | 0 |
| 33896 | 0 |
| 33897 | 0 |
| 33898 | 0 |
| 33899 | 0 |
| 33900 | 0 |
| 33901 | 0 |
| 33902 | 0 |
| 33903 | 1023 |
| 33904 | 1023 |
| 33905 | 1023 |
| 33906 | 1023 |
| 33907 | 1023 |
| 33908 | 1023 |
| 33909 | 1023 |
| 33910 | 1023 |
| 33911 | 1023 |
| 33912 | 1023 |
| 33913 | 1023 |
| 33914 | 1023 |
| 33915 | 1023 |
| 33916 | 1023 |
| 33917 | 1023 |
| 33918 | 1023 |
| 33919 | 1023 |
| 33920 | 1023 |
| 33921 | 1023 |
| 33922 | 1023 |
| 33923 | 1023 |
| 33924 | 1023 |
| 33925 | 1023 |
| 33926 | 1023 |
| 33927 | 1023 |
| 33928 | 1023 |
| 33929 | 1023 |
| 33930 | 1023 |
| 33931 | 1023 |
| 33932 | 1023 |
| 33933 | 1023 |
| 33934 | 1023 |
| 33935 | 1023 |
| 33936 | 1023 |
| 33937 | 1023 |
| 33938 | 1023 |
| 33939 | 1023 |
| 33940 | 1023 |
| 33941 | 0 |
| 33942 | 0 |
| 33943 | 0 |
| 33944 | 0 |
| 33945 | 0 |
| 33946 | 0 |
| 33947 | 0 |
| 33948 | 0 |
| 33949 | 0 |
| 33950 | 0 |
| 33951 | 0 |
| 33952 | 0 |
| 33953 | 0 |
| 33954 | 1023 |
| 33955 | 1023 |
| 33956 | 1023 |
| 33957 | 1023 |
| 33958 | 1023 |
| 33959 | 1023 |
| 33960 | 1023 |
| 33961 | 1023 |
| 33962 | 1023 |
| 33963 | 1023 |
| 33964 | 1023 |
| 33965 | 1023 |
| 33966 | 1023 |
| 33967 | 1023 |
| 33968 | 1023 |
| 33969 | 1023 |
| 33970 | 1023 |
| 33971 | 1023 |
| 33972 | 1023 |
| 33973 | 1023 |
| 33974 | 1023 |
| 33975 | 1023 |
| 33976 | 1023 |
| 33977 | 1023 |
| 33978 | 1023 |
| 33979 | 1023 |
| 33980 | 1023 |
| 33981 | 1023 |
| 33982 | 1023 |
| 33983 | 1023 |
| 33984 | 1023 |
| 33985 | 1023 |
| 33986 | 1023 |
| 33987 | 1023 |
| 33988 | 1023 |
| 33989 | 1023 |
| 33990 | 1023 |
| 33991 | 1023 |
| 33992 | 0 |
| 33993 | 0 |
| 33994 | 0 |
| 33995 | 0 |
| 33996 | 0 |
| 33997 | 0 |
| 33998 | 0 |
| 33999 | 0 |
| 34000 | 0 |
| 34001 | 0 |
| 34002 | 0 |
| 34003 | 0 |
| 34004 | 0 |
| 34005 | 1023 |
| 34006 | 1023 |
| 34007 | 1023 |
| 34008 | 1023 |
| 34009 | 1023 |
| 34010 | 1023 |
| 34011 | 1023 |
| 34012 | 1023 |
| 34013 | 1023 |
| 34014 | 1023 |
| 34015 | 1023 |
| 34016 | 1023 |
| 34017 | 1023 |
| 34018 | 1023 |
| 34019 | 1023 |
| 34020 | 1023 |
| 34021 | 1023 |
| 34022 | 1023 |
| 34023 | 1023 |
| 34024 | 1023 |
| 34025 | 1023 |
| 34026 | 1023 |
| 34027 | 1023 |
| 34028 | 1023 |
| 34029 | 1023 |
| 34030 | 1023 |
| 34031 | 1023 |
| 34032 | 1023 |
| 34033 | 1023 |
| 34034 | 1023 |
| 34035 | 1023 |
| 34036 | 1023 |
| 34037 | 1023 |
| 34038 | 1023 |
| 34039 | 1023 |
| 34040 | 1023 |
| 34041 | 1023 |
| 34042 | 1023 |
| 34043 | 0 |
| 34044 | 0 |
| 34045 | 0 |
| 34046 | 0 |
| 34047 | 0 |
| 34048 | 0 |
| 34049 | 0 |
| 34050 | 0 |
| 34051 | 0 |
| 34052 | 0 |
| 34053 | 0 |
| 34054 | 0 |
| 34055 | 0 |
| 34056 | 1023 |
| 34057 | 1023 |
| 34058 | 1023 |
| 34059 | 1023 |
| 34060 | 1023 |
| 34061 | 1023 |
| 34062 | 1023 |
| 34063 | 1023 |
| 34064 | 1023 |
| 34065 | 1023 |
| 34066 | 1023 |
| 34067 | 1023 |
| 34068 | 1023 |
| 34069 | 1023 |
| 34070 | 1023 |
| 34071 | 1023 |
| 34072 | 1023 |
| 34073 | 1023 |
| 34074 | 1023 |
| 34075 | 1023 |
| 34076 | 1023 |
| 34077 | 1023 |
| 34078 | 1023 |
| 34079 | 1023 |
| 34080 | 1023 |
| 34081 | 1023 |
| 34082 | 1023 |
| 34083 | 1023 |
| 34084 | 1023 |
| 34085 | 1023 |
| 34086 | 1023 |
| 34087 | 1023 |
| 34088 | 1023 |
| 34089 | 1023 |
| 34090 | 1023 |
| 34091 | 1023 |
| 34092 | 1023 |
| 34093 | 1023 |
| 34094 | 0 |
| 34095 | 0 |
| 34096 | 0 |
| 34097 | 0 |
| 34098 | 0 |
| 34099 | 0 |
| 34100 | 0 |
| 34101 | 0 |
| 34102 | 0 |
| 34103 | 0 |
| 34104 | 0 |
| 34105 | 0 |
| 34106 | 0 |
| 34107 | 0 |
| 34108 | 1023 |
| 34109 | 1023 |
| 34110 | 1023 |
| 34111 | 1023 |
| 34112 | 1023 |
| 34113 | 1023 |
| 34114 | 1023 |
| 34115 | 1023 |
| 34116 | 1023 |
| 34117 | 1023 |
| 34118 | 1023 |
| 34119 | 1023 |
| 34120 | 1023 |
| 34121 | 1023 |
| 34122 | 1023 |
| 34123 | 1023 |
| 34124 | 1023 |
| 34125 | 1023 |
| 34126 | 1023 |
| 34127 | 1023 |
| 34128 | 1023 |
| 34129 | 1023 |
| 34130 | 1023 |
| 34131 | 1023 |
| 34132 | 1023 |
| 34133 | 1023 |
| 34134 | 1023 |
| 34135 | 1023 |
| 34136 | 1023 |
| 34137 | 1023 |
| 34138 | 1023 |
| 34139 | 1023 |
| 34140 | 1023 |
| 34141 | 1023 |
| 34142 | 1023 |
| 34143 | 1023 |
| 34144 | 1023 |
| 34145 | 0 |
| 34146 | 0 |
| 34147 | 0 |
| 34148 | 0 |
| 34149 | 0 |
| 34150 | 0 |
| 34151 | 0 |
| 34152 | 0 |
| 34153 | 2 |
| 34154 | 0 |
| 34155 | 0 |
| 34156 | 0 |
| 34157 | 0 |
| 34158 | 0 |
| 34159 | 1023 |
| 34160 | 1023 |
| 34161 | 1023 |
| 34162 | 1023 |
| 34163 | 1023 |
| 34164 | 1023 |
| 34165 | 1023 |
| 34166 | 1023 |
| 34167 | 1023 |
| 34168 | 1023 |
| 34169 | 1023 |
| 34170 | 1023 |
| 34171 | 1023 |
| 34172 | 1023 |
| 34173 | 1023 |
| 34174 | 1023 |
| 34175 | 1023 |
| 34176 | 1023 |
| 34177 | 1023 |
| 34178 | 1023 |
| 34179 | 1023 |
| 34180 | 1023 |
| 34181 | 1023 |
| 34182 | 1023 |
| 34183 | 1023 |
| 34184 | 1023 |
| 34185 | 1023 |
| 34186 | 1023 |
| 34187 | 1023 |
| 34188 | 1023 |
| 34189 | 1023 |
| 34190 | 1023 |
| 34191 | 1023 |
| 34192 | 1023 |
| 34193 | 1023 |
| 34194 | 1023 |
| 34195 | 1023 |
| 34196 | 1023 |
| 34197 | 0 |
| 34198 | 0 |
| 34199 | 0 |
| 34200 | 0 |
| 34201 | 0 |
| 34202 | 0 |
| 34203 | 0 |
| 34204 | 0 |
| 34205 | 0 |
| 34206 | 0 |
| 34207 | 0 |
| 34208 | 0 |
| 34209 | 0 |
| 34210 | 0 |
| 34211 | 1023 |
| 34212 | 1023 |
| 34213 | 1023 |
| 34214 | 1023 |
| 34215 | 1023 |
| 34216 | 1023 |
| 34217 | 1023 |
| 34218 | 1023 |
| 34219 | 1023 |
| 34220 | 1023 |
| 34221 | 1023 |
| 34222 | 1023 |
| 34223 | 1023 |
| 34224 | 1023 |
| 34225 | 1023 |
| 34226 | 1023 |
| 34227 | 1023 |
| 34228 | 1023 |
| 34229 | 1023 |
| 34230 | 1023 |
| 34231 | 1023 |
| 34232 | 1023 |
| 34233 | 1023 |
| 34234 | 1023 |
| 34235 | 1023 |
| 34236 | 1023 |
| 34237 | 1023 |
| 34238 | 1023 |
| 34239 | 1023 |
| 34240 | 1023 |
| 34241 | 1023 |
| 34242 | 1023 |
| 34243 | 1023 |
| 34244 | 1023 |
| 34245 | 1023 |
| 34246 | 1023 |
| 34247 | 1023 |
| 34248 | 0 |
| 34249 | 0 |
| 34250 | 0 |
| 34251 | 0 |
| 34252 | 0 |
| 34253 | 0 |
| 34254 | 0 |
| 34255 | 0 |
| 34256 | 0 |
| 34257 | 0 |
| 34258 | 0 |
| 34259 | 0 |
| 34260 | 0 |
| 34261 | 0 |
| 34262 | 0 |
| 34263 | 1023 |
| 34264 | 1023 |
| 34265 | 1023 |
| 34266 | 1023 |
| 34267 | 1023 |
| 34268 | 1023 |
| 34269 | 1023 |
| 34270 | 1023 |
| 34271 | 1023 |
| 34272 | 1023 |
| 34273 | 1023 |
| 34274 | 1023 |
| 34275 | 1023 |
| 34276 | 1023 |
| 34277 | 1023 |
| 34278 | 1023 |
| 34279 | 1023 |
| 34280 | 1023 |
| 34281 | 1023 |
| 34282 | 1023 |
| 34283 | 1023 |
| 34284 | 1023 |
| 34285 | 1023 |
| 34286 | 1023 |
| 34287 | 1023 |
| 34288 | 1023 |
| 34289 | 1023 |
| 34290 | 1023 |
| 34291 | 1023 |
| 34292 | 1023 |
| 34293 | 1023 |
| 34294 | 1023 |
| 34295 | 1023 |
| 34296 | 1023 |
| 34297 | 1023 |
| 34298 | 1023 |
| 34299 | 1023 |
| 34300 | 0 |
| 34301 | 0 |
| 34302 | 0 |
| 34303 | 0 |
| 34304 | 0 |
| 34305 | 0 |
| 34306 | 0 |
| 34307 | 0 |
| 34308 | 0 |
| 34309 | 0 |
| 34310 | 0 |
| 34311 | 0 |
| 34312 | 0 |
| 34313 | 0 |
| 34314 | 0 |
| 34315 | 1023 |
| 34316 | 1023 |
| 34317 | 1023 |
| 34318 | 1023 |
| 34319 | 1023 |
| 34320 | 1023 |
| 34321 | 1023 |
| 34322 | 1023 |
| 34323 | 1023 |
| 34324 | 1023 |
| 34325 | 1023 |
| 34326 | 1023 |
| 34327 | 1023 |
| 34328 | 1023 |
| 34329 | 1023 |
| 34330 | 1023 |
| 34331 | 1023 |
| 34332 | 1023 |
| 34333 | 1023 |
| 34334 | 1023 |
| 34335 | 1023 |
| 34336 | 1023 |
| 34337 | 1023 |
| 34338 | 1023 |
| 34339 | 1023 |
| 34340 | 1023 |
| 34341 | 1023 |
| 34342 | 1023 |
| 34343 | 1023 |
| 34344 | 1023 |
| 34345 | 1023 |
| 34346 | 1023 |
| 34347 | 1023 |
| 34348 | 1023 |
| 34349 | 1023 |
| 34350 | 1023 |
| 34351 | 1023 |
| 34352 | 1023 |
| 34353 | 0 |
| 34354 | 0 |
| 34355 | 0 |
| 34356 | 0 |
| 34357 | 0 |
| 34358 | 0 |
| 34359 | 0 |
| 34360 | 0 |
| 34361 | 0 |
| 34362 | 0 |
| 34363 | 0 |
| 34364 | 0 |
| 34365 | 0 |
| 34366 | 1023 |
| 34367 | 1023 |
| 34368 | 1023 |
| 34369 | 1023 |
| 34370 | 1023 |
| 34371 | 1023 |
| 34372 | 1023 |
| 34373 | 1023 |
| 34374 | 1023 |
| 34375 | 1023 |
| 34376 | 1023 |
| 34377 | 1023 |
| 34378 | 1023 |
| 34379 | 1023 |
| 34380 | 1023 |
| 34381 | 1023 |
| 34382 | 1023 |
| 34383 | 1023 |
| 34384 | 1023 |
| 34385 | 1023 |
| 34386 | 1023 |
| 34387 | 1023 |
| 34388 | 1023 |
| 34389 | 1023 |
| 34390 | 1023 |
| 34391 | 1023 |
| 34392 | 1023 |
| 34393 | 1023 |
| 34394 | 1023 |
| 34395 | 1023 |
| 34396 | 1023 |
| 34397 | 1023 |
| 34398 | 1023 |
| 34399 | 1023 |
| 34400 | 1023 |
| 34401 | 1023 |
| 34402 | 1023 |
| 34403 | 1023 |
| 34404 | 0 |
| 34405 | 0 |
| 34406 | 0 |
| 34407 | 0 |
| 34408 | 0 |
| 34409 | 0 |
| 34410 | 0 |
| 34411 | 0 |
| 34412 | 0 |
| 34413 | 0 |
| 34414 | 0 |
| 34415 | 0 |
| 34416 | 0 |
| 34417 | 1023 |
| 34418 | 1023 |
| 34419 | 1023 |
| 34420 | 1023 |
| 34421 | 1023 |
| 34422 | 1023 |
| 34423 | 1023 |
| 34424 | 1023 |
| 34425 | 1023 |
| 34426 | 1023 |
| 34427 | 1023 |
| 34428 | 1023 |
| 34429 | 1023 |
| 34430 | 1023 |
| 34431 | 1023 |
| 34432 | 1023 |
| 34433 | 1023 |
| 34434 | 1023 |
| 34435 | 1023 |
| 34436 | 1023 |
| 34437 | 1023 |
| 34438 | 1023 |
| 34439 | 1023 |
| 34440 | 1023 |
| 34441 | 1023 |
| 34442 | 1023 |
| 34443 | 1023 |
| 34444 | 1023 |
| 34445 | 1023 |
| 34446 | 1023 |
| 34447 | 1023 |
| 34448 | 1023 |
| 34449 | 1023 |
| 34450 | 1023 |
| 34451 | 1023 |
| 34452 | 1023 |
| 34453 | 1023 |
| 34454 | 1023 |
| 34455 | 0 |
| 34456 | 0 |
| 34457 | 0 |
| 34458 | 0 |
| 34459 | 0 |
| 34460 | 0 |
| 34461 | 0 |
| 34462 | 0 |
| 34463 | 0 |
| 34464 | 0 |
| 34465 | 0 |
| 34466 | 0 |
| 34467 | 0 |
| 34468 | 1023 |
| 34469 | 1023 |
| 34470 | 1023 |
| 34471 | 1023 |
| 34472 | 1023 |
| 34473 | 1023 |
| 34474 | 1023 |
| 34475 | 1023 |
| 34476 | 1023 |
| 34477 | 1023 |
| 34478 | 1023 |
| 34479 | 1023 |
| 34480 | 1023 |
| 34481 | 1023 |
| 34482 | 1023 |
| 34483 | 1023 |
| 34484 | 1023 |
| 34485 | 1023 |
| 34486 | 1023 |
| 34487 | 1023 |
| 34488 | 1023 |
| 34489 | 1023 |
| 34490 | 1023 |
| 34491 | 1023 |
| 34492 | 1023 |
| 34493 | 1023 |
| 34494 | 1023 |
| 34495 | 1023 |
| 34496 | 1023 |
| 34497 | 1023 |
| 34498 | 1023 |
| 34499 | 1023 |
| 34500 | 1023 |
| 34501 | 1023 |
| 34502 | 1023 |
| 34503 | 1023 |
| 34504 | 1023 |
| 34505 | 1023 |
| 34506 | 0 |
| 34507 | 0 |
| 34508 | 0 |
| 34509 | 0 |
| 34510 | 0 |
| 34511 | 0 |
| 34512 | 0 |
| 34513 | 0 |
| 34514 | 0 |
| 34515 | 0 |
| 34516 | 0 |
| 34517 | 0 |
| 34518 | 0 |
| 34519 | 1023 |
| 34520 | 1023 |
| 34521 | 1023 |
| 34522 | 1023 |
| 34523 | 1023 |
| 34524 | 1023 |
| 34525 | 1023 |
| 34526 | 1023 |
| 34527 | 1023 |
| 34528 | 1023 |
| 34529 | 1023 |
| 34530 | 1023 |
| 34531 | 1023 |
| 34532 | 1023 |
| 34533 | 1023 |
| 34534 | 1023 |
| 34535 | 1023 |
| 34536 | 1023 |
| 34537 | 1023 |
| 34538 | 1023 |
| 34539 | 1023 |
| 34540 | 1023 |
| 34541 | 1023 |
| 34542 | 1023 |
| 34543 | 1023 |
| 34544 | 1023 |
| 34545 | 1023 |
| 34546 | 1023 |
| 34547 | 1023 |
| 34548 | 1023 |
| 34549 | 1023 |
| 34550 | 1023 |
| 34551 | 1023 |
| 34552 | 1023 |
| 34553 | 1023 |
| 34554 | 1023 |
| 34555 | 1023 |
| 34556 | 1023 |
| 34557 | 0 |
| 34558 | 0 |
| 34559 | 0 |
| 34560 | 0 |
| 34561 | 0 |
| 34562 | 0 |
| 34563 | 0 |
| 34564 | 0 |
| 34565 | 0 |
| 34566 | 0 |
| 34567 | 0 |
| 34568 | 0 |
| 34569 | 0 |
| 34570 | 1023 |
| 34571 | 1023 |
| 34572 | 1023 |
| 34573 | 1023 |
| 34574 | 1023 |
| 34575 | 1023 |
| 34576 | 1023 |
| 34577 | 1023 |
| 34578 | 1023 |
| 34579 | 1023 |
| 34580 | 1023 |
| 34581 | 1023 |
| 34582 | 1023 |
| 34583 | 1023 |
| 34584 | 1023 |
| 34585 | 1023 |
| 34586 | 1023 |
| 34587 | 1023 |
| 34588 | 1023 |
| 34589 | 1023 |
| 34590 | 1023 |
| 34591 | 1023 |
| 34592 | 1023 |
| 34593 | 1023 |
| 34594 | 1023 |
| 34595 | 1023 |
| 34596 | 1023 |
| 34597 | 1023 |
| 34598 | 1023 |
| 34599 | 1023 |
| 34600 | 1023 |
| 34601 | 1023 |
| 34602 | 1023 |
| 34603 | 1023 |
| 34604 | 1023 |
| 34605 | 1023 |
| 34606 | 1023 |
| 34607 | 1023 |
| 34608 | 0 |
| 34609 | 0 |
| 34610 | 0 |
| 34611 | 0 |
| 34612 | 0 |
| 34613 | 0 |
| 34614 | 0 |
| 34615 | 0 |
| 34616 | 0 |
| 34617 | 0 |
| 34618 | 0 |
| 34619 | 0 |
| 34620 | 0 |
| 34621 | 1023 |
| 34622 | 1023 |
| 34623 | 1023 |
| 34624 | 1023 |
| 34625 | 1023 |
| 34626 | 1023 |
| 34627 | 1023 |
| 34628 | 1023 |
| 34629 | 1023 |
| 34630 | 1023 |
| 34631 | 1023 |
| 34632 | 1023 |
| 34633 | 1023 |
| 34634 | 1023 |
| 34635 | 1023 |
| 34636 | 1023 |
| 34637 | 1023 |
| 34638 | 1023 |
| 34639 | 1023 |
| 34640 | 1023 |
| 34641 | 1023 |
| 34642 | 1023 |
| 34643 | 1023 |
| 34644 | 1023 |
| 34645 | 1023 |
| 34646 | 1023 |
| 34647 | 1023 |
| 34648 | 1023 |
| 34649 | 1023 |
| 34650 | 1023 |
| 34651 | 1023 |
| 34652 | 1023 |
| 34653 | 1023 |
| 34654 | 1023 |
| 34655 | 1023 |
| 34656 | 1023 |
| 34657 | 1023 |
| 34658 | 1023 |
| 34659 | 0 |
| 34660 | 0 |
| 34661 | 0 |
| 34662 | 0 |
| 34663 | 0 |
| 34664 | 0 |
| 34665 | 0 |
| 34666 | 0 |
| 34667 | 0 |
| 34668 | 0 |
| 34669 | 0 |
| 34670 | 0 |
| 34671 | 0 |
| 34672 | 1023 |
| 34673 | 1023 |
| 34674 | 1023 |
| 34675 | 1023 |
| 34676 | 1023 |
| 34677 | 1023 |
| 34678 | 1023 |
| 34679 | 1023 |
| 34680 | 1023 |
| 34681 | 1023 |
| 34682 | 1023 |
| 34683 | 1023 |
| 34684 | 1023 |
| 34685 | 1023 |
| 34686 | 1023 |
| 34687 | 1023 |
| 34688 | 1023 |
| 34689 | 1023 |
| 34690 | 1023 |
| 34691 | 1023 |
| 34692 | 1023 |
| 34693 | 1023 |
| 34694 | 1023 |
| 34695 | 1023 |
| 34696 | 1023 |
| 34697 | 1023 |
| 34698 | 1023 |
| 34699 | 1023 |
| 34700 | 1023 |
| 34701 | 1023 |
| 34702 | 1023 |
| 34703 | 1023 |
| 34704 | 1023 |
| 34705 | 1023 |
| 34706 | 1023 |
| 34707 | 1023 |
| 34708 | 1023 |
| 34709 | 1023 |
| 34710 | 0 |
| 34711 | 0 |
| 34712 | 0 |
| 34713 | 0 |
| 34714 | 0 |
| 34715 | 0 |
| 34716 | 0 |
| 34717 | 0 |
| 34718 | 0 |
| 34719 | 0 |
| 34720 | 0 |
| 34721 | 0 |
| 34722 | 0 |
| 34723 | 0 |
| 34724 | 1023 |
| 34725 | 1023 |
| 34726 | 1023 |
| 34727 | 1023 |
| 34728 | 1023 |
| 34729 | 1023 |
| 34730 | 1023 |
| 34731 | 1023 |
| 34732 | 1023 |
| 34733 | 1023 |
| 34734 | 1023 |
| 34735 | 1023 |
| 34736 | 1023 |
| 34737 | 1023 |
| 34738 | 1023 |
| 34739 | 1023 |
| 34740 | 1023 |
| 34741 | 1023 |
| 34742 | 1023 |
| 34743 | 1023 |
| 34744 | 1023 |
| 34745 | 1023 |
| 34746 | 1023 |
| 34747 | 1023 |
| 34748 | 1023 |
| 34749 | 1023 |
| 34750 | 1023 |
| 34751 | 1023 |
| 34752 | 1023 |
| 34753 | 1023 |
| 34754 | 1023 |
| 34755 | 1023 |
| 34756 | 1023 |
| 34757 | 1023 |
| 34758 | 1023 |
| 34759 | 1023 |
| 34760 | 1023 |
| 34761 | 0 |
| 34762 | 0 |
| 34763 | 0 |
| 34764 | 0 |
| 34765 | 0 |
| 34766 | 0 |
| 34767 | 0 |
| 34768 | 0 |
| 34769 | 0 |
| 34770 | 0 |
| 34771 | 0 |
| 34772 | 0 |
| 34773 | 0 |
| 34774 | 0 |
| 34775 | 1023 |
| 34776 | 1023 |
| 34777 | 1023 |
| 34778 | 1023 |
| 34779 | 1023 |
| 34780 | 1023 |
| 34781 | 1023 |
| 34782 | 1023 |
| 34783 | 1023 |
| 34784 | 1023 |
| 34785 | 1023 |
| 34786 | 1023 |
| 34787 | 1023 |
| 34788 | 1023 |
| 34789 | 1023 |
| 34790 | 1023 |
| 34791 | 1023 |
| 34792 | 1023 |
| 34793 | 1023 |
| 34794 | 1023 |
| 34795 | 1023 |
| 34796 | 1023 |
| 34797 | 1023 |
| 34798 | 1023 |
| 34799 | 1023 |
| 34800 | 1023 |
| 34801 | 1023 |
| 34802 | 1023 |
| 34803 | 1023 |
| 34804 | 1023 |
| 34805 | 1023 |
| 34806 | 1023 |
| 34807 | 1023 |
| 34808 | 1023 |
| 34809 | 1023 |
| 34810 | 1023 |
| 34811 | 1023 |
| 34812 | 1023 |
| 34813 | 0 |
| 34814 | 0 |
| 34815 | 0 |
| 34816 | 0 |
| 34817 | 0 |
| 34818 | 0 |
| 34819 | 0 |
| 34820 | 0 |
| 34821 | 0 |
| 34822 | 0 |
| 34823 | 0 |
| 34824 | 0 |
| 34825 | 0 |
| 34826 | 0 |
| 34827 | 1023 |
| 34828 | 1023 |
| 34829 | 1023 |
| 34830 | 1023 |
| 34831 | 1023 |
| 34832 | 1023 |
| 34833 | 1023 |
| 34834 | 1023 |
| 34835 | 1023 |
| 34836 | 1023 |
| 34837 | 1023 |
| 34838 | 1023 |
| 34839 | 1023 |
| 34840 | 1023 |
| 34841 | 1023 |
| 34842 | 1023 |
| 34843 | 1023 |
| 34844 | 1023 |
| 34845 | 1023 |
| 34846 | 1023 |
| 34847 | 1023 |
| 34848 | 1023 |
| 34849 | 1023 |
| 34850 | 1023 |
| 34851 | 1023 |
| 34852 | 1023 |
| 34853 | 1023 |
| 34854 | 1023 |
| 34855 | 1023 |
| 34856 | 1023 |
| 34857 | 1023 |
| 34858 | 1023 |
| 34859 | 1023 |
| 34860 | 1023 |
| 34861 | 1023 |
| 34862 | 1023 |
| 34863 | 1023 |
| 34864 | 0 |
| 34865 | 0 |
| 34866 | 0 |
| 34867 | 0 |
| 34868 | 0 |
| 34869 | 0 |
| 34870 | 0 |
| 34871 | 0 |
| 34872 | 0 |
| 34873 | 0 |
| 34874 | 0 |
| 34875 | 0 |
| 34876 | 0 |
| 34877 | 0 |
| 34878 | 0 |
| 34879 | 1023 |
| 34880 | 1023 |
| 34881 | 1023 |
| 34882 | 1023 |
| 34883 | 1023 |
| 34884 | 1023 |
| 34885 | 1023 |
| 34886 | 1023 |
| 34887 | 1023 |
| 34888 | 1023 |
| 34889 | 1023 |
| 34890 | 1023 |
| 34891 | 1023 |
| 34892 | 1023 |
| 34893 | 1023 |
| 34894 | 1023 |
| 34895 | 1023 |
| 34896 | 1023 |
| 34897 | 1023 |
| 34898 | 1023 |
| 34899 | 1023 |
| 34900 | 1023 |
| 34901 | 1023 |
| 34902 | 1023 |
| 34903 | 1023 |
| 34904 | 1023 |
| 34905 | 1023 |
| 34906 | 1023 |
| 34907 | 1023 |
| 34908 | 1023 |
| 34909 | 1023 |
| 34910 | 1023 |
| 34911 | 1023 |
| 34912 | 1023 |
| 34913 | 1023 |
| 34914 | 1023 |
| 34915 | 1023 |
| 34916 | 0 |
| 34917 | 0 |
| 34918 | 0 |
| 34919 | 0 |
| 34920 | 0 |
| 34921 | 0 |
| 34922 | 0 |
| 34923 | 0 |
| 34924 | 0 |
| 34925 | 0 |
| 34926 | 0 |
| 34927 | 0 |
| 34928 | 0 |
| 34929 | 0 |
| 34930 | 0 |
| 34931 | 1023 |
| 34932 | 1023 |
| 34933 | 1023 |
| 34934 | 1023 |
| 34935 | 1023 |
| 34936 | 1023 |
| 34937 | 1023 |
| 34938 | 1023 |
| 34939 | 1023 |
| 34940 | 1023 |
| 34941 | 1023 |
| 34942 | 1023 |
| 34943 | 1023 |
| 34944 | 1023 |
| 34945 | 1023 |
| 34946 | 1023 |
| 34947 | 1023 |
| 34948 | 1023 |
| 34949 | 1023 |
| 34950 | 1023 |
| 34951 | 1023 |
| 34952 | 1023 |
| 34953 | 1023 |
| 34954 | 1023 |
| 34955 | 1023 |
| 34956 | 1023 |
| 34957 | 1023 |
| 34958 | 1023 |
| 34959 | 1023 |
| 34960 | 1023 |
| 34961 | 1023 |
| 34962 | 1023 |
| 34963 | 1023 |
| 34964 | 1023 |
| 34965 | 1023 |
| 34966 | 1023 |
| 34967 | 1023 |
| 34968 | 1023 |
| 34969 | 0 |
| 34970 | 0 |
| 34971 | 0 |
| 34972 | 0 |
| 34973 | 0 |
| 34974 | 0 |
| 34975 | 0 |
| 34976 | 0 |
| 34977 | 0 |
| 34978 | 0 |
| 34979 | 0 |
| 34980 | 0 |
| 34981 | 0 |
| 34982 | 1023 |
| 34983 | 1023 |
| 34984 | 1023 |
| 34985 | 1023 |
| 34986 | 1023 |
| 34987 | 1023 |
| 34988 | 1023 |
| 34989 | 1023 |
| 34990 | 1023 |
| 34991 | 1023 |
| 34992 | 1023 |
| 34993 | 1023 |
| 34994 | 1023 |
| 34995 | 1023 |
| 34996 | 1023 |
| 34997 | 1023 |
| 34998 | 1023 |
| 34999 | 1023 |
| 35000 | 1023 |
| 35001 | 1023 |
| 35002 | 1023 |
| 35003 | 1023 |
| 35004 | 1023 |
| 35005 | 1023 |
| 35006 | 1023 |
| 35007 | 1023 |
| 35008 | 1023 |
| 35009 | 1023 |
| 35010 | 1023 |
| 35011 | 1023 |
| 35012 | 1023 |
| 35013 | 1023 |
| 35014 | 1023 |
| 35015 | 1023 |
| 35016 | 1023 |
| 35017 | 1023 |
| 35018 | 1023 |
| 35019 | 1023 |
| 35020 | 0 |
| 35021 | 0 |
| 35022 | 0 |
| 35023 | 0 |
| 35024 | 1 |
| 35025 | 0 |
| 35026 | 0 |
| 35027 | 0 |
| 35028 | 0 |
| 35029 | 0 |
| 35030 | 0 |
| 35031 | 0 |
| 35032 | 0 |
| 35033 | 1023 |
| 35034 | 1023 |
| 35035 | 1023 |
| 35036 | 1023 |
| 35037 | 1023 |
| 35038 | 1023 |
| 35039 | 1023 |
| 35040 | 1023 |
| 35041 | 1023 |
| 35042 | 1023 |
| 35043 | 1023 |
| 35044 | 1023 |
| 35045 | 1023 |
| 35046 | 1023 |
| 35047 | 1023 |
| 35048 | 1023 |
| 35049 | 1023 |
| 35050 | 1023 |
| 35051 | 1023 |
| 35052 | 1023 |
| 35053 | 1023 |
| 35054 | 1023 |
| 35055 | 1023 |
| 35056 | 1023 |
| 35057 | 1023 |
| 35058 | 1023 |
| 35059 | 1023 |
| 35060 | 1023 |
| 35061 | 1023 |
| 35062 | 1023 |
| 35063 | 1023 |
| 35064 | 1023 |
| 35065 | 1023 |
| 35066 | 1023 |
| 35067 | 1023 |
| 35068 | 1023 |
| 35069 | 1023 |
| 35070 | 1023 |
| 35071 | 0 |
| 35072 | 0 |
| 35073 | 0 |
| 35074 | 0 |
| 35075 | 0 |
| 35076 | 0 |
| 35077 | 0 |
| 35078 | 0 |
| 35079 | 0 |
| 35080 | 0 |
| 35081 | 0 |
| 35082 | 0 |
| 35083 | 1 |
| 35084 | 1023 |
| 35085 | 1023 |
| 35086 | 1023 |
| 35087 | 1023 |
| 35088 | 1023 |
| 35089 | 1023 |
| 35090 | 1023 |
| 35091 | 1023 |
| 35092 | 1023 |
| 35093 | 1023 |
| 35094 | 1023 |
| 35095 | 1023 |
| 35096 | 1023 |
| 35097 | 1023 |
| 35098 | 1023 |
| 35099 | 1023 |
| 35100 | 1023 |
| 35101 | 1023 |
| 35102 | 1023 |
| 35103 | 1023 |
| 35104 | 1023 |
| 35105 | 1023 |
| 35106 | 1023 |
| 35107 | 1023 |
| 35108 | 1023 |
| 35109 | 1023 |
| 35110 | 1023 |
| 35111 | 1023 |
| 35112 | 1023 |
| 35113 | 1023 |
| 35114 | 1023 |
| 35115 | 1023 |
| 35116 | 1023 |
| 35117 | 1023 |
| 35118 | 1023 |
| 35119 | 1023 |
| 35120 | 1023 |
| 35121 | 1023 |
| 35122 | 0 |
| 35123 | 0 |
| 35124 | 0 |
| 35125 | 0 |
| 35126 | 0 |
| 35127 | 0 |
| 35128 | 0 |
| 35129 | 0 |
| 35130 | 0 |
| 35131 | 0 |
| 35132 | 0 |
| 35133 | 0 |
| 35134 | 0 |
| 35135 | 1023 |
| 35136 | 1023 |
| 35137 | 1023 |
| 35138 | 1023 |
| 35139 | 1023 |
| 35140 | 1023 |
| 35141 | 1023 |
| 35142 | 1023 |
| 35143 | 1023 |
| 35144 | 1023 |
| 35145 | 1023 |
| 35146 | 1023 |
| 35147 | 1023 |
| 35148 | 1023 |
| 35149 | 1023 |
| 35150 | 1023 |
| 35151 | 1023 |
| 35152 | 1023 |
| 35153 | 1023 |
| 35154 | 1023 |
| 35155 | 1023 |
| 35156 | 1023 |
| 35157 | 1023 |
| 35158 | 1023 |
| 35159 | 1023 |
| 35160 | 1023 |
| 35161 | 1023 |
| 35162 | 1023 |
| 35163 | 1023 |
| 35164 | 1023 |
| 35165 | 1023 |
| 35166 | 1023 |
| 35167 | 1023 |
| 35168 | 1023 |
| 35169 | 1023 |
| 35170 | 1023 |
| 35171 | 1023 |
| 35172 | 1023 |
| 35173 | 0 |
| 35174 | 0 |
| 35175 | 0 |
| 35176 | 0 |
| 35177 | 0 |
| 35178 | 0 |
| 35179 | 0 |
| 35180 | 0 |
| 35181 | 0 |
| 35182 | 0 |
| 35183 | 0 |
| 35184 | 0 |
| 35185 | 0 |
| 35186 | 1023 |
| 35187 | 1023 |
| 35188 | 1023 |
| 35189 | 1023 |
| 35190 | 1023 |
| 35191 | 1023 |
| 35192 | 1023 |
| 35193 | 1023 |
| 35194 | 1023 |
| 35195 | 1023 |
| 35196 | 1023 |
| 35197 | 1023 |
| 35198 | 1023 |
| 35199 | 1023 |
| 35200 | 1023 |
| 35201 | 1023 |
| 35202 | 1023 |
| 35203 | 1023 |
| 35204 | 1023 |
| 35205 | 1023 |
| 35206 | 1023 |
| 35207 | 1023 |
| 35208 | 1023 |
| 35209 | 1023 |
| 35210 | 1023 |
| 35211 | 1023 |
| 35212 | 1023 |
| 35213 | 1023 |
| 35214 | 1023 |
| 35215 | 1023 |
| 35216 | 1023 |
| 35217 | 1023 |
| 35218 | 1023 |
| 35219 | 1023 |
| 35220 | 1023 |
| 35221 | 1023 |
| 35222 | 1023 |
| 35223 | 1023 |
| 35224 | 0 |
| 35225 | 0 |
| 35226 | 0 |
| 35227 | 0 |
| 35228 | 0 |
| 35229 | 0 |
| 35230 | 0 |
| 35231 | 0 |
| 35232 | 0 |
| 35233 | 0 |
| 35234 | 0 |
| 35235 | 0 |
| 35236 | 0 |
| 35237 | 1023 |
| 35238 | 1023 |
| 35239 | 1023 |
| 35240 | 1023 |
| 35241 | 1023 |
| 35242 | 1023 |
| 35243 | 1023 |
| 35244 | 1023 |
| 35245 | 1023 |
| 35246 | 1023 |
| 35247 | 1023 |
| 35248 | 1023 |
| 35249 | 1023 |
| 35250 | 1023 |
| 35251 | 1023 |
| 35252 | 1023 |
| 35253 | 1023 |
| 35254 | 1023 |
| 35255 | 1023 |
| 35256 | 1023 |
| 35257 | 1023 |
| 35258 | 1023 |
| 35259 | 1023 |
| 35260 | 1023 |
| 35261 | 1023 |
| 35262 | 1023 |
| 35263 | 1023 |
| 35264 | 1023 |
| 35265 | 1023 |
| 35266 | 1023 |
| 35267 | 1023 |
| 35268 | 1023 |
| 35269 | 1023 |
| 35270 | 1023 |
| 35271 | 1023 |
| 35272 | 1023 |
| 35273 | 1023 |
| 35274 | 1023 |
| 35275 | 0 |
| 35276 | 0 |
| 35277 | 0 |
| 35278 | 0 |
| 35279 | 0 |
| 35280 | 0 |
| 35281 | 0 |
| 35282 | 0 |
| 35283 | 0 |
| 35284 | 0 |
| 35285 | 0 |
| 35286 | 0 |
| 35287 | 0 |
| 35288 | 0 |
| 35289 | 1023 |
| 35290 | 1023 |
| 35291 | 1023 |
| 35292 | 1023 |
| 35293 | 1023 |
| 35294 | 1023 |
| 35295 | 1023 |
| 35296 | 1023 |
| 35297 | 1023 |
| 35298 | 1023 |
| 35299 | 1023 |
| 35300 | 1023 |
| 35301 | 1023 |
| 35302 | 1023 |
| 35303 | 1023 |
| 35304 | 1023 |
| 35305 | 1023 |
| 35306 | 1023 |
| 35307 | 1023 |
| 35308 | 1023 |
| 35309 | 1023 |
| 35310 | 1023 |
| 35311 | 1023 |
| 35312 | 1023 |
| 35313 | 1023 |
| 35314 | 1023 |
| 35315 | 1023 |
| 35316 | 1023 |
| 35317 | 1023 |
| 35318 | 1023 |
| 35319 | 1023 |
| 35320 | 1023 |
| 35321 | 1023 |
| 35322 | 1023 |
| 35323 | 1023 |
| 35324 | 1023 |
| 35325 | 1023 |
| 35326 | 0 |
| 35327 | 0 |
| 35328 | 0 |
| 35329 | 0 |
| 35330 | 0 |
| 35331 | 0 |
| 35332 | 0 |
| 35333 | 0 |
| 35334 | 0 |
| 35335 | 0 |
| 35336 | 0 |
| 35337 | 0 |
| 35338 | 0 |
| 35339 | 0 |
| 35340 | 1023 |
| 35341 | 1023 |
| 35342 | 1023 |
| 35343 | 1023 |
| 35344 | 1023 |
| 35345 | 1023 |
| 35346 | 1023 |
| 35347 | 1023 |
| 35348 | 1023 |
| 35349 | 1023 |
| 35350 | 1023 |
| 35351 | 1023 |
| 35352 | 1023 |
| 35353 | 1023 |
| 35354 | 1023 |
| 35355 | 1023 |
| 35356 | 1023 |
| 35357 | 1023 |
| 35358 | 1023 |
| 35359 | 1023 |
| 35360 | 1023 |
| 35361 | 1023 |
| 35362 | 1023 |
| 35363 | 1023 |
| 35364 | 1023 |
| 35365 | 1023 |
| 35366 | 1023 |
| 35367 | 1023 |
| 35368 | 1023 |
| 35369 | 1023 |
| 35370 | 1023 |
| 35371 | 1023 |
| 35372 | 1023 |
| 35373 | 1023 |
| 35374 | 1023 |
| 35375 | 1023 |
| 35376 | 1023 |
| 35377 | 1023 |
| 35378 | 0 |
| 35379 | 0 |
| 35380 | 0 |
| 35381 | 0 |
| 35382 | 0 |
| 35383 | 0 |
| 35384 | 0 |
| 35385 | 0 |
| 35386 | 0 |
| 35387 | 0 |
| 35388 | 0 |
| 35389 | 0 |
| 35390 | 0 |
| 35391 | 0 |
| 35392 | 1023 |
| 35393 | 1023 |
| 35394 | 1023 |
| 35395 | 1023 |
| 35396 | 1023 |
| 35397 | 1023 |
| 35398 | 1023 |
| 35399 | 1023 |
| 35400 | 1023 |
| 35401 | 1023 |
| 35402 | 1023 |
| 35403 | 1023 |
| 35404 | 1023 |
| 35405 | 1023 |
| 35406 | 1023 |
| 35407 | 1023 |
| 35408 | 1023 |
| 35409 | 1023 |
| 35410 | 1023 |
| 35411 | 1023 |
| 35412 | 1023 |
| 35413 | 1023 |
| 35414 | 1023 |
| 35415 | 1023 |
| 35416 | 1023 |
| 35417 | 1023 |
| 35418 | 1023 |
| 35419 | 1023 |
| 35420 | 1023 |
| 35421 | 1023 |
| 35422 | 1023 |
| 35423 | 1023 |
| 35424 | 1023 |
| 35425 | 1023 |
| 35426 | 1023 |
| 35427 | 1023 |
| 35428 | 1023 |
| 35429 | 0 |
| 35430 | 0 |
| 35431 | 0 |
| 35432 | 0 |
| 35433 | 0 |
| 35434 | 0 |
| 35435 | 0 |
| 35436 | 0 |
| 35437 | 0 |
| 35438 | 0 |
| 35439 | 0 |
| 35440 | 0 |
| 35441 | 0 |
| 35442 | 0 |
| 35443 | 0 |
| 35444 | 1023 |
| 35445 | 1023 |
| 35446 | 1023 |
| 35447 | 1023 |
| 35448 | 1023 |
| 35449 | 1023 |
| 35450 | 1023 |
| 35451 | 1023 |
| 35452 | 1023 |
| 35453 | 1023 |
| 35454 | 1023 |
| 35455 | 1023 |
| 35456 | 1023 |
| 35457 | 1023 |
| 35458 | 1023 |
| 35459 | 1023 |
| 35460 | 1023 |
| 35461 | 1023 |
| 35462 | 1023 |
| 35463 | 1023 |
| 35464 | 1023 |
| 35465 | 1023 |
| 35466 | 1023 |
| 35467 | 1023 |
| 35468 | 1023 |
| 35469 | 1023 |
| 35470 | 1023 |
| 35471 | 1023 |
| 35472 | 1023 |
| 35473 | 1023 |
| 35474 | 1023 |
| 35475 | 1023 |
| 35476 | 1023 |
| 35477 | 1023 |
| 35478 | 1023 |
| 35479 | 1023 |
| 35480 | 1023 |
| 35481 | 0 |
| 35482 | 0 |
| 35483 | 0 |
| 35484 | 0 |
| 35485 | 0 |
| 35486 | 0 |
| 35487 | 0 |
| 35488 | 0 |
| 35489 | 0 |
| 35490 | 0 |
| 35491 | 0 |
| 35492 | 0 |
| 35493 | 0 |
| 35494 | 0 |
| 35495 | 0 |
| 35496 | 1023 |
| 35497 | 1023 |
| 35498 | 1023 |
| 35499 | 1023 |
| 35500 | 1023 |
| 35501 | 1023 |
| 35502 | 1023 |
| 35503 | 1023 |
| 35504 | 1023 |
| 35505 | 1023 |
| 35506 | 1023 |
| 35507 | 1023 |
| 35508 | 1023 |
| 35509 | 1023 |
| 35510 | 1023 |
| 35511 | 1023 |
| 35512 | 1023 |
| 35513 | 1023 |
| 35514 | 1023 |
| 35515 | 1023 |
| 35516 | 1023 |
| 35517 | 1023 |
| 35518 | 1023 |
| 35519 | 1023 |
| 35520 | 1023 |
| 35521 | 1023 |
| 35522 | 1023 |
| 35523 | 1023 |
| 35524 | 1023 |
| 35525 | 1023 |
| 35526 | 1023 |
| 35527 | 1023 |
| 35528 | 1023 |
| 35529 | 1023 |
| 35530 | 1023 |
| 35531 | 1023 |
| 35532 | 1023 |
| 35533 | 623 |
| 35534 | 0 |
| 35535 | 0 |
| 35536 | 0 |
| 35537 | 0 |
| 35538 | 0 |
| 35539 | 0 |
| 35540 | 0 |
| 35541 | 0 |
| 35542 | 0 |
| 35543 | 0 |
| 35544 | 0 |
| 35545 | 0 |
| 35546 | 0 |
| 35547 | 1023 |
| 35548 | 1023 |
| 35549 | 1023 |
| 35550 | 1023 |
| 35551 | 1023 |
| 35552 | 1023 |
| 35553 | 1023 |
| 35554 | 1023 |
| 35555 | 1023 |
| 35556 | 1023 |
| 35557 | 1023 |
| 35558 | 1023 |
| 35559 | 1023 |
| 35560 | 1023 |
| 35561 | 1023 |
| 35562 | 1023 |
| 35563 | 1023 |
| 35564 | 1023 |
| 35565 | 1023 |
| 35566 | 1023 |
| 35567 | 1023 |
| 35568 | 1023 |
| 35569 | 1023 |
| 35570 | 1023 |
| 35571 | 1023 |
| 35572 | 1023 |
| 35573 | 1023 |
| 35574 | 1023 |
| 35575 | 1023 |
| 35576 | 1023 |
| 35577 | 1023 |
| 35578 | 1023 |
| 35579 | 1023 |
| 35580 | 1023 |
| 35581 | 1023 |
| 35582 | 1023 |
| 35583 | 1023 |
| 35584 | 1023 |
| 35585 | 0 |
| 35586 | 0 |
| 35587 | 0 |
| 35588 | 0 |
| 35589 | 0 |
| 35590 | 0 |
| 35591 | 1 |
| 35592 | 0 |
| 35593 | 0 |
| 35594 | 0 |
| 35595 | 0 |
| 35596 | 0 |
| 35597 | 0 |
| 35598 | 1023 |
| 35599 | 1023 |
| 35600 | 1023 |
| 35601 | 1023 |
| 35602 | 1023 |
| 35603 | 1023 |
| 35604 | 1023 |
| 35605 | 1023 |
| 35606 | 1023 |
| 35607 | 1023 |
| 35608 | 1023 |
| 35609 | 1023 |
| 35610 | 1023 |
| 35611 | 1023 |
| 35612 | 1023 |
| 35613 | 1023 |
| 35614 | 1023 |
| 35615 | 1023 |
| 35616 | 1023 |
| 35617 | 1023 |
| 35618 | 1023 |
| 35619 | 1023 |
| 35620 | 1023 |
| 35621 | 1023 |
| 35622 | 1023 |
| 35623 | 1023 |
| 35624 | 1023 |
| 35625 | 1023 |
| 35626 | 1023 |
| 35627 | 1023 |
| 35628 | 1023 |
| 35629 | 1023 |
| 35630 | 1023 |
| 35631 | 1023 |
| 35632 | 1023 |
| 35633 | 1023 |
| 35634 | 1023 |
| 35635 | 1023 |
| 35636 | 0 |
| 35637 | 0 |
| 35638 | 0 |
| 35639 | 0 |
| 35640 | 0 |
| 35641 | 0 |
| 35642 | 0 |
| 35643 | 0 |
| 35644 | 0 |
| 35645 | 0 |
| 35646 | 0 |
| 35647 | 0 |
| 35648 | 0 |
| 35649 | 1023 |
| 35650 | 1023 |
| 35651 | 1023 |
| 35652 | 1023 |
| 35653 | 1023 |
| 35654 | 1023 |
| 35655 | 1023 |
| 35656 | 1023 |
| 35657 | 1023 |
| 35658 | 1023 |
| 35659 | 1023 |
| 35660 | 1023 |
| 35661 | 1023 |
| 35662 | 1023 |
| 35663 | 1023 |
| 35664 | 1023 |
| 35665 | 1023 |
| 35666 | 1023 |
| 35667 | 1023 |
| 35668 | 1023 |
| 35669 | 1023 |
| 35670 | 1023 |
| 35671 | 1023 |
| 35672 | 1023 |
| 35673 | 1023 |
| 35674 | 1023 |
| 35675 | 1023 |
| 35676 | 1023 |
| 35677 | 1023 |
| 35678 | 1023 |
| 35679 | 1023 |
| 35680 | 1023 |
| 35681 | 1023 |
| 35682 | 1023 |
| 35683 | 1023 |
| 35684 | 1023 |
| 35685 | 1023 |
| 35686 | 1023 |
| 35687 | 0 |
| 35688 | 0 |
| 35689 | 0 |
| 35690 | 0 |
| 35691 | 0 |
| 35692 | 0 |
| 35693 | 0 |
| 35694 | 0 |
| 35695 | 0 |
| 35696 | 0 |
| 35697 | 0 |
| 35698 | 0 |
| 35699 | 0 |
| 35700 | 1023 |
| 35701 | 1023 |
| 35702 | 1023 |
| 35703 | 1023 |
| 35704 | 1023 |
| 35705 | 1023 |
| 35706 | 1023 |
| 35707 | 1023 |
| 35708 | 1023 |
| 35709 | 1023 |
| 35710 | 1023 |
| 35711 | 1023 |
| 35712 | 1023 |
| 35713 | 1023 |
| 35714 | 1023 |
| 35715 | 1023 |
| 35716 | 1023 |
| 35717 | 1023 |
| 35718 | 1023 |
| 35719 | 1023 |
| 35720 | 1023 |
| 35721 | 1023 |
| 35722 | 1023 |
| 35723 | 1023 |
| 35724 | 1023 |
| 35725 | 1023 |
| 35726 | 1023 |
| 35727 | 1023 |
| 35728 | 1023 |
| 35729 | 1023 |
| 35730 | 1023 |
| 35731 | 1023 |
| 35732 | 1023 |
| 35733 | 1023 |
| 35734 | 1023 |
| 35735 | 1023 |
| 35736 | 1023 |
| 35737 | 1023 |
| 35738 | 0 |
| 35739 | 0 |
| 35740 | 0 |
| 35741 | 0 |
| 35742 | 0 |
| 35743 | 0 |
| 35744 | 0 |
| 35745 | 0 |
| 35746 | 0 |
| 35747 | 0 |
| 35748 | 0 |
| 35749 | 0 |
| 35750 | 0 |
| 35751 | 0 |
| 35752 | 1023 |
| 35753 | 1023 |
| 35754 | 1023 |
| 35755 | 1023 |
| 35756 | 1023 |
| 35757 | 1023 |
| 35758 | 1023 |
| 35759 | 1023 |
| 35760 | 1023 |
| 35761 | 1023 |
| 35762 | 1023 |
| 35763 | 1023 |
| 35764 | 1023 |
| 35765 | 1023 |
| 35766 | 1023 |
| 35767 | 1023 |
| 35768 | 1023 |
| 35769 | 1023 |
| 35770 | 1023 |
| 35771 | 1023 |
| 35772 | 1023 |
| 35773 | 1023 |
| 35774 | 1023 |
| 35775 | 1023 |
| 35776 | 1023 |
| 35777 | 1023 |
| 35778 | 1023 |
| 35779 | 1023 |
| 35780 | 1023 |
| 35781 | 1023 |
| 35782 | 1023 |
| 35783 | 1023 |
| 35784 | 1023 |
| 35785 | 1023 |
| 35786 | 1023 |
| 35787 | 1023 |
| 35788 | 1023 |
| 35789 | 0 |
| 35790 | 0 |
| 35791 | 0 |
| 35792 | 0 |
| 35793 | 0 |
| 35794 | 0 |
| 35795 | 0 |
| 35796 | 0 |
| 35797 | 0 |
| 35798 | 0 |
| 35799 | 0 |
| 35800 | 0 |
| 35801 | 0 |
| 35802 | 0 |
| 35803 | 1023 |
| 35804 | 1023 |
| 35805 | 1023 |
| 35806 | 1023 |
| 35807 | 1023 |
| 35808 | 1023 |
| 35809 | 1023 |
| 35810 | 1023 |
| 35811 | 1023 |
| 35812 | 1023 |
| 35813 | 1023 |
| 35814 | 1023 |
| 35815 | 1023 |
| 35816 | 1023 |
| 35817 | 1023 |
| 35818 | 1023 |
| 35819 | 1023 |
| 35820 | 1023 |
| 35821 | 1023 |
| 35822 | 1023 |
| 35823 | 1023 |
| 35824 | 1023 |
| 35825 | 1023 |
| 35826 | 1023 |
| 35827 | 1023 |
| 35828 | 1023 |
| 35829 | 1023 |
| 35830 | 1023 |
| 35831 | 1023 |
| 35832 | 1023 |
| 35833 | 1023 |
| 35834 | 1023 |
| 35835 | 1023 |
| 35836 | 1023 |
| 35837 | 1023 |
| 35838 | 1023 |
| 35839 | 1023 |
| 35840 | 1023 |
| 35841 | 0 |
| 35842 | 0 |
| 35843 | 0 |
| 35844 | 0 |
| 35845 | 0 |
| 35846 | 0 |
| 35847 | 0 |
| 35848 | 0 |
| 35849 | 0 |
| 35850 | 0 |
| 35851 | 0 |
| 35852 | 0 |
| 35853 | 0 |
| 35854 | 0 |
| 35855 | 1023 |
| 35856 | 1023 |
| 35857 | 1023 |
| 35858 | 1023 |
| 35859 | 1023 |
| 35860 | 1023 |
| 35861 | 1023 |
| 35862 | 1023 |
| 35863 | 1023 |
| 35864 | 1023 |
| 35865 | 1023 |
| 35866 | 1023 |
| 35867 | 1023 |
| 35868 | 1023 |
| 35869 | 1023 |
| 35870 | 1023 |
| 35871 | 1023 |
| 35872 | 1023 |
| 35873 | 1023 |
| 35874 | 1023 |
| 35875 | 1023 |
| 35876 | 1023 |
| 35877 | 1023 |
| 35878 | 1023 |
| 35879 | 1023 |
| 35880 | 1023 |
| 35881 | 1023 |
| 35882 | 1023 |
| 35883 | 1023 |
| 35884 | 1023 |
| 35885 | 1023 |
| 35886 | 1023 |
| 35887 | 1023 |
| 35888 | 1023 |
| 35889 | 1023 |
| 35890 | 1023 |
| 35891 | 1023 |
| 35892 | 0 |
| 35893 | 0 |
| 35894 | 0 |
| 35895 | 0 |
| 35896 | 0 |
| 35897 | 0 |
| 35898 | 0 |
| 35899 | 0 |
| 35900 | 0 |
| 35901 | 0 |
| 35902 | 0 |
| 35903 | 0 |
| 35904 | 0 |
| 35905 | 0 |
| 35906 | 0 |
| 35907 | 1023 |
| 35908 | 1023 |
| 35909 | 1023 |
| 35910 | 1023 |
| 35911 | 1023 |
| 35912 | 1023 |
| 35913 | 1023 |
| 35914 | 1023 |
| 35915 | 1023 |
| 35916 | 1023 |
| 35917 | 1023 |
| 35918 | 1023 |
| 35919 | 1023 |
| 35920 | 1023 |
| 35921 | 1023 |
| 35922 | 1023 |
| 35923 | 1023 |
| 35924 | 1023 |
| 35925 | 1023 |
| 35926 | 1023 |
| 35927 | 1023 |
| 35928 | 1023 |
| 35929 | 1023 |
| 35930 | 1023 |
| 35931 | 1023 |
| 35932 | 1023 |
| 35933 | 1023 |
| 35934 | 1023 |
| 35935 | 1023 |
| 35936 | 1023 |
| 35937 | 1023 |
| 35938 | 1023 |
| 35939 | 1023 |
| 35940 | 1023 |
| 35941 | 1023 |
| 35942 | 1023 |
| 35943 | 1023 |
| 35944 | 0 |
| 35945 | 0 |
| 35946 | 0 |
| 35947 | 0 |
| 35948 | 0 |
| 35949 | 0 |
| 35950 | 0 |
| 35951 | 0 |
| 35952 | 0 |
| 35953 | 0 |
| 35954 | 0 |
| 35955 | 0 |
| 35956 | 0 |
| 35957 | 0 |
| 35958 | 0 |
| 35959 | 1023 |
| 35960 | 1023 |
| 35961 | 1023 |
| 35962 | 1023 |
| 35963 | 1023 |
| 35964 | 1023 |
| 35965 | 1023 |
| 35966 | 1023 |
| 35967 | 1023 |
| 35968 | 1023 |
| 35969 | 1023 |
| 35970 | 1023 |
| 35971 | 1023 |
| 35972 | 1023 |
| 35973 | 1023 |
| 35974 | 1023 |
| 35975 | 1023 |
| 35976 | 1023 |
| 35977 | 1023 |
| 35978 | 1023 |
| 35979 | 1023 |
| 35980 | 1023 |
| 35981 | 1023 |
| 35982 | 1023 |
| 35983 | 1023 |
| 35984 | 1023 |
| 35985 | 1023 |
| 35986 | 1023 |
| 35987 | 1023 |
| 35988 | 1023 |
| 35989 | 1023 |
| 35990 | 1023 |
| 35991 | 1023 |
| 35992 | 1023 |
| 35993 | 1023 |
| 35994 | 1023 |
| 35995 | 1023 |
| 35996 | 1023 |
| 35997 | 0 |
| 35998 | 0 |
| 35999 | 0 |
| 36000 | 0 |
| 36001 | 0 |
| 36002 | 0 |
| 36003 | 0 |
| 36004 | 0 |
| 36005 | 0 |
| 36006 | 0 |
| 36007 | 0 |
| 36008 | 0 |
| 36009 | 0 |
| 36010 | 1023 |
| 36011 | 1023 |
| 36012 | 1023 |
| 36013 | 1023 |
| 36014 | 1023 |
| 36015 | 1023 |
| 36016 | 1023 |
| 36017 | 1023 |
| 36018 | 1023 |
| 36019 | 1023 |
| 36020 | 1023 |
| 36021 | 1023 |
| 36022 | 1023 |
| 36023 | 1023 |
| 36024 | 1023 |
| 36025 | 1023 |
| 36026 | 1023 |
| 36027 | 1023 |
| 36028 | 1023 |
| 36029 | 1023 |
| 36030 | 1023 |
| 36031 | 1023 |
| 36032 | 1023 |
| 36033 | 1023 |
| 36034 | 1023 |
| 36035 | 1023 |
| 36036 | 1023 |
| 36037 | 1023 |
| 36038 | 1023 |
| 36039 | 1023 |
| 36040 | 1023 |
| 36041 | 1023 |
| 36042 | 1023 |
| 36043 | 1023 |
| 36044 | 1023 |
| 36045 | 1023 |
| 36046 | 1023 |
| 36047 | 1023 |
| 36048 | 0 |
| 36049 | 0 |
| 36050 | 0 |
| 36051 | 0 |
| 36052 | 0 |
| 36053 | 0 |
| 36054 | 0 |
| 36055 | 0 |
| 36056 | 0 |
| 36057 | 0 |
| 36058 | 0 |
| 36059 | 0 |
| 36060 | 0 |
| 36061 | 1023 |
| 36062 | 1023 |
| 36063 | 1023 |
| 36064 | 1023 |
| 36065 | 1023 |
| 36066 | 1023 |
| 36067 | 1023 |
| 36068 | 1023 |
| 36069 | 1023 |
| 36070 | 1023 |
| 36071 | 1023 |
| 36072 | 1023 |
| 36073 | 1023 |
| 36074 | 1023 |
| 36075 | 1023 |
| 36076 | 1023 |
| 36077 | 1023 |
| 36078 | 1023 |
| 36079 | 1023 |
| 36080 | 1023 |
| 36081 | 1023 |
| 36082 | 1023 |
| 36083 | 1023 |
| 36084 | 1023 |
| 36085 | 1023 |
| 36086 | 1023 |
| 36087 | 1023 |
| 36088 | 1023 |
| 36089 | 1023 |
| 36090 | 1023 |
| 36091 | 1023 |
| 36092 | 1023 |
| 36093 | 1023 |
| 36094 | 1023 |
| 36095 | 1023 |
| 36096 | 1023 |
| 36097 | 1023 |
| 36098 | 1023 |
| 36099 | 0 |
| 36100 | 0 |
| 36101 | 0 |
| 36102 | 0 |
| 36103 | 0 |
| 36104 | 0 |
| 36105 | 0 |
| 36106 | 0 |
| 36107 | 0 |
| 36108 | 0 |
| 36109 | 0 |
| 36110 | 0 |
| 36111 | 0 |
| 36112 | 1023 |
| 36113 | 1023 |
| 36114 | 1023 |
| 36115 | 1023 |
| 36116 | 1023 |
| 36117 | 1023 |
| 36118 | 1023 |
| 36119 | 1023 |
| 36120 | 1023 |
| 36121 | 1023 |
| 36122 | 1023 |
| 36123 | 1023 |
| 36124 | 1023 |
| 36125 | 1023 |
| 36126 | 1023 |
| 36127 | 1023 |
| 36128 | 1023 |
| 36129 | 1023 |
| 36130 | 1023 |
| 36131 | 1023 |
| 36132 | 1023 |
| 36133 | 1023 |
| 36134 | 1023 |
| 36135 | 1023 |
| 36136 | 1023 |
| 36137 | 1023 |
| 36138 | 1023 |
| 36139 | 1023 |
| 36140 | 1023 |
| 36141 | 1023 |
| 36142 | 1023 |
| 36143 | 1023 |
| 36144 | 1023 |
| 36145 | 1023 |
| 36146 | 1023 |
| 36147 | 1023 |
| 36148 | 1023 |
| 36149 | 1023 |
| 36150 | 0 |
| 36151 | 0 |
| 36152 | 0 |
| 36153 | 0 |
| 36154 | 0 |
| 36155 | 0 |
| 36156 | 0 |
| 36157 | 0 |
| 36158 | 0 |
| 36159 | 0 |
| 36160 | 0 |
| 36161 | 0 |
| 36162 | 0 |
| 36163 | 1023 |
| 36164 | 1023 |
| 36165 | 1023 |
| 36166 | 1023 |
| 36167 | 1023 |
| 36168 | 1023 |
| 36169 | 1023 |
| 36170 | 1023 |
| 36171 | 1023 |
| 36172 | 1023 |
| 36173 | 1023 |
| 36174 | 1023 |
| 36175 | 1023 |
| 36176 | 1023 |
| 36177 | 1023 |
| 36178 | 1023 |
| 36179 | 1023 |
| 36180 | 1023 |
| 36181 | 1023 |
| 36182 | 1023 |
| 36183 | 1023 |
| 36184 | 1023 |
| 36185 | 1023 |
| 36186 | 1023 |
| 36187 | 1023 |
| 36188 | 1023 |
| 36189 | 1023 |
| 36190 | 1023 |
| 36191 | 1023 |
| 36192 | 1023 |
| 36193 | 1023 |
| 36194 | 1023 |
| 36195 | 1023 |
| 36196 | 1023 |
| 36197 | 1023 |
| 36198 | 1023 |
| 36199 | 1023 |
| 36200 | 1023 |
| 36201 | 0 |
| 36202 | 0 |
| 36203 | 0 |
| 36204 | 0 |
| 36205 | 0 |
| 36206 | 0 |
| 36207 | 0 |
| 36208 | 0 |
| 36209 | 0 |
| 36210 | 0 |
| 36211 | 0 |
| 36212 | 0 |
| 36213 | 0 |
| 36214 | 1023 |
| 36215 | 1023 |
| 36216 | 1023 |
| 36217 | 1023 |
| 36218 | 1023 |
| 36219 | 1023 |
| 36220 | 1023 |
| 36221 | 1023 |
| 36222 | 1023 |
| 36223 | 1023 |
| 36224 | 1023 |
| 36225 | 1023 |
| 36226 | 1023 |
| 36227 | 1023 |
| 36228 | 1023 |
| 36229 | 1023 |
| 36230 | 1023 |
| 36231 | 1023 |
| 36232 | 1023 |
| 36233 | 1023 |
| 36234 | 1023 |
| 36235 | 1023 |
| 36236 | 1023 |
| 36237 | 1023 |
| 36238 | 1023 |
| 36239 | 1023 |
| 36240 | 1023 |
| 36241 | 1023 |
| 36242 | 1023 |
| 36243 | 1023 |
| 36244 | 1023 |
| 36245 | 1023 |
| 36246 | 1023 |
| 36247 | 1023 |
| 36248 | 1023 |
| 36249 | 1023 |
| 36250 | 1023 |
| 36251 | 1023 |
| 36252 | 0 |
| 36253 | 0 |
| 36254 | 0 |
| 36255 | 0 |
| 36256 | 0 |
| 36257 | 0 |
| 36258 | 0 |
| 36259 | 0 |
| 36260 | 0 |
| 36261 | 0 |
| 36262 | 0 |
| 36263 | 0 |
| 36264 | 0 |
| 36265 | 1023 |
| 36266 | 1023 |
| 36267 | 1023 |
| 36268 | 1023 |
| 36269 | 1023 |
| 36270 | 1023 |
| 36271 | 1023 |
| 36272 | 1023 |
| 36273 | 1023 |
| 36274 | 1023 |
| 36275 | 1023 |
| 36276 | 1023 |
| 36277 | 1023 |
| 36278 | 1023 |
| 36279 | 1023 |
| 36280 | 1023 |
| 36281 | 1023 |
| 36282 | 1023 |
| 36283 | 1023 |
| 36284 | 1023 |
| 36285 | 1023 |
| 36286 | 1023 |
| 36287 | 1023 |
| 36288 | 1023 |
| 36289 | 1023 |
| 36290 | 1023 |
| 36291 | 1023 |
| 36292 | 1023 |
| 36293 | 1023 |
| 36294 | 1023 |
| 36295 | 1023 |
| 36296 | 1023 |
| 36297 | 1023 |
| 36298 | 1023 |
| 36299 | 1023 |
| 36300 | 1023 |
| 36301 | 1023 |
| 36302 | 1023 |
| 36303 | 0 |
| 36304 | 0 |
| 36305 | 0 |
| 36306 | 0 |
| 36307 | 0 |
| 36308 | 0 |
| 36309 | 0 |
| 36310 | 0 |
| 36311 | 0 |
| 36312 | 0 |
| 36313 | 0 |
| 36314 | 0 |
| 36315 | 0 |
| 36316 | 0 |
| 36317 | 1023 |
| 36318 | 1023 |
| 36319 | 1023 |
| 36320 | 1023 |
| 36321 | 1023 |
| 36322 | 1023 |
| 36323 | 1023 |
| 36324 | 1023 |
| 36325 | 1023 |
| 36326 | 1023 |
| 36327 | 1023 |
| 36328 | 1023 |
| 36329 | 1023 |
| 36330 | 1023 |
| 36331 | 1023 |
| 36332 | 1023 |
| 36333 | 1023 |
| 36334 | 1023 |
| 36335 | 1023 |
| 36336 | 1023 |
| 36337 | 1023 |
| 36338 | 1023 |
| 36339 | 1023 |
| 36340 | 1023 |
| 36341 | 1023 |
| 36342 | 1023 |
| 36343 | 1023 |
| 36344 | 1023 |
| 36345 | 1023 |
| 36346 | 1023 |
| 36347 | 1023 |
| 36348 | 1023 |
| 36349 | 1023 |
| 36350 | 1023 |
| 36351 | 1023 |
| 36352 | 1023 |
| 36353 | 1023 |
| 36354 | 0 |
| 36355 | 0 |
| 36356 | 0 |
| 36357 | 0 |
| 36358 | 0 |
| 36359 | 0 |
| 36360 | 0 |
| 36361 | 0 |
| 36362 | 0 |
| 36363 | 0 |
| 36364 | 0 |
| 36365 | 0 |
| 36366 | 0 |
| 36367 | 0 |
| 36368 | 1023 |
| 36369 | 1023 |
| 36370 | 1023 |
| 36371 | 1023 |
| 36372 | 1023 |
| 36373 | 1023 |
| 36374 | 1023 |
| 36375 | 1023 |
| 36376 | 1023 |
| 36377 | 1023 |
| 36378 | 1023 |
| 36379 | 1023 |
| 36380 | 1023 |
| 36381 | 1023 |
| 36382 | 1023 |
| 36383 | 1023 |
| 36384 | 1023 |
| 36385 | 1023 |
| 36386 | 1023 |
| 36387 | 1023 |
| 36388 | 1023 |
| 36389 | 1023 |
| 36390 | 1023 |
| 36391 | 1023 |
| 36392 | 1023 |
| 36393 | 1023 |
| 36394 | 1023 |
| 36395 | 1023 |
| 36396 | 1023 |
| 36397 | 1023 |
| 36398 | 1023 |
| 36399 | 1023 |
| 36400 | 1023 |
| 36401 | 1023 |
| 36402 | 1023 |
| 36403 | 1023 |
| 36404 | 1023 |
| 36405 | 1023 |
| 36406 | 0 |
| 36407 | 0 |
| 36408 | 0 |
| 36409 | 0 |
| 36410 | 0 |
| 36411 | 0 |
| 36412 | 0 |
| 36413 | 0 |
| 36414 | 0 |
| 36415 | 0 |
| 36416 | 0 |
| 36417 | 0 |
| 36418 | 0 |
| 36419 | 0 |
| 36420 | 1023 |
| 36421 | 1023 |
| 36422 | 1023 |
| 36423 | 1023 |
| 36424 | 1023 |
| 36425 | 1023 |
| 36426 | 1023 |
| 36427 | 1023 |
| 36428 | 1023 |
| 36429 | 1023 |
| 36430 | 1023 |
| 36431 | 1023 |
| 36432 | 1023 |
| 36433 | 1023 |
| 36434 | 1023 |
| 36435 | 1023 |
| 36436 | 1023 |
| 36437 | 1023 |
| 36438 | 1023 |
| 36439 | 1023 |
| 36440 | 1023 |
| 36441 | 1023 |
| 36442 | 1023 |
| 36443 | 1023 |
| 36444 | 1023 |
| 36445 | 1023 |
| 36446 | 1023 |
| 36447 | 1023 |
| 36448 | 1023 |
| 36449 | 1023 |
| 36450 | 1023 |
| 36451 | 1023 |
| 36452 | 1023 |
| 36453 | 1023 |
| 36454 | 1023 |
| 36455 | 1023 |
| 36456 | 1023 |
| 36457 | 0 |
| 36458 | 0 |
| 36459 | 0 |
| 36460 | 0 |
| 36461 | 0 |
| 36462 | 0 |
| 36463 | 0 |
| 36464 | 0 |
| 36465 | 0 |
| 36466 | 0 |
| 36467 | 0 |
| 36468 | 0 |
| 36469 | 0 |
| 36470 | 0 |
| 36471 | 0 |
| 36472 | 1023 |
| 36473 | 1023 |
| 36474 | 1023 |
| 36475 | 1023 |
| 36476 | 1023 |
| 36477 | 1023 |
| 36478 | 1023 |
| 36479 | 1023 |
| 36480 | 1023 |
| 36481 | 1023 |
| 36482 | 1023 |
| 36483 | 1023 |
| 36484 | 1023 |
| 36485 | 1023 |
| 36486 | 1023 |
| 36487 | 1023 |
| 36488 | 1023 |
| 36489 | 1023 |
| 36490 | 1023 |
| 36491 | 1023 |
| 36492 | 1023 |
| 36493 | 1023 |
| 36494 | 1023 |
| 36495 | 1023 |
| 36496 | 1023 |
| 36497 | 1023 |
| 36498 | 1023 |
| 36499 | 1023 |
| 36500 | 1023 |
| 36501 | 1023 |
| 36502 | 1023 |
| 36503 | 1023 |
| 36504 | 1023 |
| 36505 | 1023 |
| 36506 | 1023 |
| 36507 | 1023 |
| 36508 | 1023 |
| 36509 | 0 |
| 36510 | 0 |
| 36511 | 0 |
| 36512 | 0 |
| 36513 | 0 |
| 36514 | 0 |
| 36515 | 0 |
| 36516 | 0 |
| 36517 | 0 |
| 36518 | 0 |
| 36519 | 0 |
| 36520 | 0 |
| 36521 | 0 |
| 36522 | 0 |
| 36523 | 0 |
| 36524 | 1023 |
| 36525 | 1023 |
| 36526 | 1023 |
| 36527 | 1023 |
| 36528 | 1023 |
| 36529 | 1023 |
| 36530 | 1023 |
| 36531 | 1023 |
| 36532 | 1023 |
| 36533 | 1023 |
| 36534 | 1023 |
| 36535 | 1023 |
| 36536 | 1023 |
| 36537 | 1023 |
| 36538 | 1023 |
| 36539 | 1023 |
| 36540 | 1023 |
| 36541 | 1023 |
| 36542 | 1023 |
| 36543 | 1023 |
| 36544 | 1023 |
| 36545 | 1023 |
| 36546 | 1023 |
| 36547 | 1023 |
| 36548 | 1023 |
| 36549 | 1023 |
| 36550 | 1023 |
| 36551 | 1023 |
| 36552 | 1023 |
| 36553 | 1023 |
| 36554 | 1023 |
| 36555 | 1023 |
| 36556 | 1023 |
| 36557 | 1023 |
| 36558 | 1023 |
| 36559 | 1023 |
| 36560 | 1023 |
| 36561 | 0 |
| 36562 | 0 |
| 36563 | 0 |
| 36564 | 0 |
| 36565 | 0 |
| 36566 | 0 |
| 36567 | 0 |
| 36568 | 0 |
| 36569 | 0 |
| 36570 | 0 |
| 36571 | 0 |
| 36572 | 0 |
| 36573 | 0 |
| 36574 | 0 |
| 36575 | 0 |
| 36576 | 1023 |
| 36577 | 1023 |
| 36578 | 1023 |
| 36579 | 1023 |
| 36580 | 1023 |
| 36581 | 1023 |
| 36582 | 1023 |
| 36583 | 1023 |
| 36584 | 1023 |
| 36585 | 1023 |
| 36586 | 1023 |
| 36587 | 1023 |
| 36588 | 1023 |
| 36589 | 1023 |
| 36590 | 1023 |
| 36591 | 1023 |
| 36592 | 1023 |
| 36593 | 1023 |
| 36594 | 1023 |
| 36595 | 1023 |
| 36596 | 1023 |
| 36597 | 1023 |
| 36598 | 1023 |
| 36599 | 1023 |
| 36600 | 1023 |
| 36601 | 1023 |
| 36602 | 1023 |
| 36603 | 1023 |
| 36604 | 1023 |
| 36605 | 1023 |
| 36606 | 1023 |
| 36607 | 1023 |
| 36608 | 1023 |
| 36609 | 1023 |
| 36610 | 1023 |
| 36611 | 1023 |
| 36612 | 1023 |
| 36613 | 1023 |
| 36614 | 0 |
| 36615 | 0 |
| 36616 | 0 |
| 36617 | 0 |
| 36618 | 0 |
| 36619 | 0 |
| 36620 | 0 |
| 36621 | 0 |
| 36622 | 0 |
| 36623 | 0 |
| 36624 | 0 |
| 36625 | 0 |
| 36626 | 0 |
| 36627 | 1023 |
| 36628 | 1023 |
| 36629 | 1023 |
| 36630 | 1023 |
| 36631 | 1023 |
| 36632 | 1023 |
| 36633 | 1023 |
| 36634 | 1023 |
| 36635 | 1023 |
| 36636 | 1023 |
| 36637 | 1023 |
| 36638 | 1023 |
| 36639 | 1023 |
| 36640 | 1023 |
| 36641 | 1023 |
| 36642 | 1023 |
| 36643 | 1023 |
| 36644 | 1023 |
| 36645 | 1023 |
| 36646 | 1023 |
| 36647 | 1023 |
| 36648 | 1023 |
| 36649 | 1023 |
| 36650 | 1023 |
| 36651 | 1023 |
| 36652 | 1023 |
| 36653 | 1023 |
| 36654 | 1023 |
| 36655 | 1023 |
| 36656 | 1023 |
| 36657 | 1023 |
| 36658 | 1023 |
| 36659 | 1023 |
| 36660 | 1023 |
| 36661 | 1023 |
| 36662 | 1023 |
| 36663 | 1023 |
| 36664 | 1023 |
| 36665 | 0 |
| 36666 | 0 |
| 36667 | 0 |
| 36668 | 0 |
| 36669 | 0 |
| 36670 | 0 |
| 36671 | 0 |
| 36672 | 0 |
| 36673 | 0 |
| 36674 | 0 |
| 36675 | 0 |
| 36676 | 0 |
| 36677 | 0 |
| 36678 | 1023 |
| 36679 | 1023 |
| 36680 | 1023 |
| 36681 | 1023 |
| 36682 | 1023 |
| 36683 | 1023 |
| 36684 | 1023 |
| 36685 | 1023 |
| 36686 | 1023 |
| 36687 | 1023 |
| 36688 | 1023 |
| 36689 | 1023 |
| 36690 | 1023 |
| 36691 | 1023 |
| 36692 | 1023 |
| 36693 | 1023 |
| 36694 | 1023 |
| 36695 | 1023 |
| 36696 | 1023 |
| 36697 | 1023 |
| 36698 | 1023 |
| 36699 | 1023 |
| 36700 | 1023 |
| 36701 | 1023 |
| 36702 | 1023 |
| 36703 | 1023 |
| 36704 | 1023 |
| 36705 | 1023 |
| 36706 | 1023 |
| 36707 | 1023 |
| 36708 | 1023 |
| 36709 | 1023 |
| 36710 | 1023 |
| 36711 | 1023 |
| 36712 | 1023 |
| 36713 | 1023 |
| 36714 | 1023 |
| 36715 | 1023 |
| 36716 | 0 |
| 36717 | 0 |
| 36718 | 0 |
| 36719 | 0 |
| 36720 | 0 |
| 36721 | 0 |
| 36722 | 0 |
| 36723 | 0 |
| 36724 | 0 |
| 36725 | 0 |
| 36726 | 0 |
| 36727 | 0 |
| 36728 | 0 |
| 36729 | 1023 |
| 36730 | 1023 |
| 36731 | 1023 |
| 36732 | 1023 |
| 36733 | 1023 |
| 36734 | 1023 |
| 36735 | 1023 |
| 36736 | 1023 |
| 36737 | 1023 |
| 36738 | 1023 |
| 36739 | 1023 |
| 36740 | 1023 |
| 36741 | 1023 |
| 36742 | 1023 |
| 36743 | 1023 |
| 36744 | 1023 |
| 36745 | 1023 |
| 36746 | 1023 |
| 36747 | 1023 |
| 36748 | 1023 |
| 36749 | 1023 |
| 36750 | 1023 |
| 36751 | 1023 |
| 36752 | 1023 |
| 36753 | 1023 |
| 36754 | 1023 |
| 36755 | 1023 |
| 36756 | 1023 |
| 36757 | 1023 |
| 36758 | 1023 |
| 36759 | 1023 |
| 36760 | 1023 |
| 36761 | 1023 |
| 36762 | 1023 |
| 36763 | 1023 |
| 36764 | 1023 |
| 36765 | 1023 |
| 36766 | 1023 |
| 36767 | 0 |
| 36768 | 0 |
| 36769 | 0 |
| 36770 | 0 |
| 36771 | 0 |
| 36772 | 0 |
| 36773 | 0 |
| 36774 | 0 |
| 36775 | 0 |
| 36776 | 0 |
| 36777 | 0 |
| 36778 | 0 |
| 36779 | 0 |
| 36780 | 1023 |
| 36781 | 1023 |
| 36782 | 1023 |
| 36783 | 1023 |
| 36784 | 1023 |
| 36785 | 1023 |
| 36786 | 1023 |
| 36787 | 1023 |
| 36788 | 1023 |
| 36789 | 1023 |
| 36790 | 1023 |
| 36791 | 1023 |
| 36792 | 1023 |
| 36793 | 1023 |
| 36794 | 1023 |
| 36795 | 1023 |
| 36796 | 1023 |
| 36797 | 1023 |
| 36798 | 1023 |
| 36799 | 1023 |
| 36800 | 1023 |
| 36801 | 1023 |
| 36802 | 1023 |
| 36803 | 1023 |
| 36804 | 1023 |
| 36805 | 1023 |
| 36806 | 1023 |
| 36807 | 1023 |
| 36808 | 1023 |
| 36809 | 1023 |
| 36810 | 1023 |
| 36811 | 1023 |
| 36812 | 1023 |
| 36813 | 1023 |
| 36814 | 1023 |
| 36815 | 1023 |
| 36816 | 1023 |
| 36817 | 1023 |
| 36818 | 0 |
| 36819 | 0 |
| 36820 | 0 |
| 36821 | 0 |
| 36822 | 0 |
| 36823 | 0 |
| 36824 | 0 |
| 36825 | 0 |
| 36826 | 0 |
| 36827 | 0 |
| 36828 | 0 |
| 36829 | 0 |
| 36830 | 0 |
| 36831 | 1023 |
| 36832 | 1023 |
| 36833 | 1023 |
| 36834 | 1023 |
| 36835 | 1023 |
| 36836 | 1023 |
| 36837 | 1023 |
| 36838 | 1023 |
| 36839 | 1023 |
| 36840 | 1023 |
| 36841 | 1023 |
| 36842 | 1023 |
| 36843 | 1023 |
| 36844 | 1023 |
| 36845 | 1023 |
| 36846 | 1023 |
| 36847 | 1023 |
| 36848 | 1023 |
| 36849 | 1023 |
| 36850 | 1023 |
| 36851 | 1023 |
| 36852 | 1023 |
| 36853 | 1023 |
| 36854 | 1023 |
| 36855 | 1023 |
| 36856 | 1023 |
| 36857 | 1023 |
| 36858 | 1023 |
| 36859 | 1023 |
| 36860 | 1023 |
| 36861 | 1023 |
| 36862 | 1023 |
| 36863 | 1023 |
| 36864 | 1023 |
| 36865 | 1023 |
| 36866 | 1023 |
| 36867 | 1023 |
| 36868 | 1023 |
| 36869 | 0 |
| 36870 | 0 |
| 36871 | 0 |
| 36872 | 0 |
| 36873 | 0 |
| 36874 | 0 |
| 36875 | 0 |
| 36876 | 0 |
| 36877 | 0 |
| 36878 | 0 |
| 36879 | 0 |
| 36880 | 0 |
| 36881 | 0 |
| 36882 | 1023 |
| 36883 | 1023 |
| 36884 | 1023 |
| 36885 | 1023 |
| 36886 | 1023 |
| 36887 | 1023 |
| 36888 | 1023 |
| 36889 | 1023 |
| 36890 | 1023 |
| 36891 | 1023 |
| 36892 | 1023 |
| 36893 | 1023 |
| 36894 | 1023 |
| 36895 | 1023 |
| 36896 | 1023 |
| 36897 | 1023 |
| 36898 | 1023 |
| 36899 | 1023 |
| 36900 | 1023 |
| 36901 | 1023 |
| 36902 | 1023 |
| 36903 | 1023 |
| 36904 | 1023 |
| 36905 | 1023 |
| 36906 | 1023 |
| 36907 | 1023 |
| 36908 | 1023 |
| 36909 | 1023 |
| 36910 | 1023 |
| 36911 | 1023 |
| 36912 | 1023 |
| 36913 | 1023 |
| 36914 | 1023 |
| 36915 | 1023 |
| 36916 | 1023 |
| 36917 | 1023 |
| 36918 | 1023 |
| 36919 | 1023 |
| 36920 | 0 |
| 36921 | 0 |
| 36922 | 0 |
| 36923 | 0 |
| 36924 | 0 |
| 36925 | 0 |
| 36926 | 0 |
| 36927 | 0 |
| 36928 | 0 |
| 36929 | 0 |
| 36930 | 0 |
| 36931 | 0 |
| 36932 | 0 |
| 36933 | 0 |
| 36934 | 1023 |
| 36935 | 1023 |
| 36936 | 1023 |
| 36937 | 1023 |
| 36938 | 1023 |
| 36939 | 1023 |
| 36940 | 1023 |
| 36941 | 1023 |
| 36942 | 1023 |
| 36943 | 1023 |
| 36944 | 1023 |
| 36945 | 1023 |
| 36946 | 1023 |
| 36947 | 1023 |
| 36948 | 1023 |
| 36949 | 1023 |
| 36950 | 1023 |
| 36951 | 1023 |
| 36952 | 1023 |
| 36953 | 1023 |
| 36954 | 1023 |
| 36955 | 1023 |
| 36956 | 1023 |
| 36957 | 1023 |
| 36958 | 1023 |
| 36959 | 1023 |
| 36960 | 1023 |
| 36961 | 1023 |
| 36962 | 1023 |
| 36963 | 1023 |
| 36964 | 1023 |
| 36965 | 1023 |
| 36966 | 1023 |
| 36967 | 1023 |
| 36968 | 1023 |
| 36969 | 1023 |
| 36970 | 1023 |
| 36971 | 0 |
| 36972 | 0 |
| 36973 | 0 |
| 36974 | 0 |
| 36975 | 0 |
| 36976 | 0 |
| 36977 | 0 |
| 36978 | 0 |
| 36979 | 0 |
| 36980 | 0 |
| 36981 | 0 |
| 36982 | 0 |
| 36983 | 0 |
| 36984 | 0 |
| 36985 | 1023 |
| 36986 | 1023 |
| 36987 | 1023 |
| 36988 | 1023 |
| 36989 | 1023 |
| 36990 | 1023 |
| 36991 | 1023 |
| 36992 | 1023 |
| 36993 | 1023 |
| 36994 | 1023 |
| 36995 | 1023 |
| 36996 | 1023 |
| 36997 | 1023 |
| 36998 | 1023 |
| 36999 | 1023 |
| 37000 | 1023 |
| 37001 | 1023 |
| 37002 | 1023 |
| 37003 | 1023 |
| 37004 | 1023 |
| 37005 | 1023 |
| 37006 | 1023 |
| 37007 | 1023 |
| 37008 | 1023 |
| 37009 | 1023 |
| 37010 | 1023 |
| 37011 | 1023 |
| 37012 | 1023 |
| 37013 | 1023 |
| 37014 | 1023 |
| 37015 | 1023 |
| 37016 | 1023 |
| 37017 | 1023 |
| 37018 | 1023 |
| 37019 | 1023 |
| 37020 | 1023 |
| 37021 | 1023 |
| 37022 | 1023 |
| 37023 | 0 |
| 37024 | 0 |
| 37025 | 0 |
| 37026 | 0 |
| 37027 | 0 |
| 37028 | 0 |
| 37029 | 0 |
| 37030 | 0 |
| 37031 | 0 |
| 37032 | 0 |
| 37033 | 0 |
| 37034 | 0 |
| 37035 | 0 |
| 37036 | 0 |
| 37037 | 1023 |
| 37038 | 1023 |
| 37039 | 1023 |
| 37040 | 1023 |
| 37041 | 1023 |
| 37042 | 1023 |
| 37043 | 1023 |
| 37044 | 1023 |
| 37045 | 1023 |
| 37046 | 1023 |
| 37047 | 1023 |
| 37048 | 1023 |
| 37049 | 1023 |
| 37050 | 1023 |
| 37051 | 1023 |
| 37052 | 1023 |
| 37053 | 1023 |
| 37054 | 1023 |
| 37055 | 1023 |
| 37056 | 1023 |
| 37057 | 1023 |
| 37058 | 1023 |
| 37059 | 1023 |
| 37060 | 1023 |
| 37061 | 1023 |
| 37062 | 1023 |
| 37063 | 1023 |
| 37064 | 1023 |
| 37065 | 1023 |
| 37066 | 1023 |
| 37067 | 1023 |
| 37068 | 1023 |
| 37069 | 1023 |
| 37070 | 1023 |
| 37071 | 1023 |
| 37072 | 1023 |
| 37073 | 1023 |
| 37074 | 0 |
| 37075 | 0 |
| 37076 | 0 |
| 37077 | 0 |
| 37078 | 0 |
| 37079 | 0 |
| 37080 | 0 |
| 37081 | 0 |
| 37082 | 0 |
| 37083 | 1 |
| 37084 | 0 |
| 37085 | 0 |
| 37086 | 0 |
| 37087 | 0 |
| 37088 | 0 |
| 37089 | 1023 |
| 37090 | 1023 |
| 37091 | 1023 |
| 37092 | 1023 |
| 37093 | 1023 |
| 37094 | 1023 |
| 37095 | 1023 |
| 37096 | 1023 |
| 37097 | 1023 |
| 37098 | 1023 |
| 37099 | 1023 |
| 37100 | 1023 |
| 37101 | 1023 |
| 37102 | 1023 |
| 37103 | 1023 |
| 37104 | 1023 |
| 37105 | 1023 |
| 37106 | 1023 |
| 37107 | 1023 |
| 37108 | 1023 |
| 37109 | 1023 |
| 37110 | 1023 |
| 37111 | 1023 |
| 37112 | 1023 |
| 37113 | 1023 |
| 37114 | 1023 |
| 37115 | 1023 |
| 37116 | 1023 |
| 37117 | 1023 |
| 37118 | 1023 |
| 37119 | 1023 |
| 37120 | 1023 |
| 37121 | 1023 |
| 37122 | 1023 |
| 37123 | 1023 |
| 37124 | 1023 |
| 37125 | 1023 |
| 37126 | 0 |
| 37127 | 0 |
| 37128 | 0 |
| 37129 | 0 |
| 37130 | 0 |
| 37131 | 0 |
| 37132 | 0 |
| 37133 | 0 |
| 37134 | 0 |
| 37135 | 0 |
| 37136 | 0 |
| 37137 | 0 |
| 37138 | 0 |
| 37139 | 0 |
| 37140 | 0 |
| 37141 | 1023 |
| 37142 | 1023 |
| 37143 | 1023 |
| 37144 | 1023 |
| 37145 | 1023 |
| 37146 | 1023 |
| 37147 | 1023 |
| 37148 | 1023 |
| 37149 | 1023 |
| 37150 | 1023 |
| 37151 | 1023 |
| 37152 | 1023 |
| 37153 | 1023 |
| 37154 | 1023 |
| 37155 | 1023 |
| 37156 | 1023 |
| 37157 | 1023 |
| 37158 | 1023 |
| 37159 | 1023 |
| 37160 | 1023 |
| 37161 | 1023 |
| 37162 | 1023 |
| 37163 | 1023 |
| 37164 | 1023 |
| 37165 | 1023 |
| 37166 | 1023 |
| 37167 | 1023 |
| 37168 | 1023 |
| 37169 | 1023 |
| 37170 | 1023 |
| 37171 | 1023 |
| 37172 | 1023 |
| 37173 | 1023 |
| 37174 | 1023 |
| 37175 | 1023 |
| 37176 | 1023 |
| 37177 | 1023 |
| 37178 | 1023 |
| 37179 | 0 |
| 37180 | 0 |
| 37181 | 0 |
| 37182 | 0 |
| 37183 | 0 |
| 37184 | 0 |
| 37185 | 0 |
| 37186 | 0 |
| 37187 | 0 |
| 37188 | 0 |
| 37189 | 0 |
| 37190 | 0 |
| 37191 | 0 |
| 37192 | 1023 |
| 37193 | 1023 |
| 37194 | 1023 |
| 37195 | 1023 |
| 37196 | 1023 |
| 37197 | 1023 |
| 37198 | 1023 |
| 37199 | 1023 |
| 37200 | 1023 |
| 37201 | 1023 |
| 37202 | 1023 |
| 37203 | 1023 |
| 37204 | 1023 |
| 37205 | 1023 |
| 37206 | 1023 |
| 37207 | 1023 |
| 37208 | 1023 |
| 37209 | 1023 |
| 37210 | 1023 |
| 37211 | 1023 |
| 37212 | 1023 |
| 37213 | 1023 |
| 37214 | 1023 |
| 37215 | 1023 |
| 37216 | 1023 |
| 37217 | 1023 |
| 37218 | 1023 |
| 37219 | 1023 |
| 37220 | 1023 |
| 37221 | 1023 |
| 37222 | 1023 |
| 37223 | 1023 |
| 37224 | 1023 |
| 37225 | 1023 |
| 37226 | 1023 |
| 37227 | 1023 |
| 37228 | 1023 |
| 37229 | 1023 |
| 37230 | 0 |
| 37231 | 0 |
| 37232 | 0 |
| 37233 | 0 |
| 37234 | 0 |
| 37235 | 0 |
| 37236 | 0 |
| 37237 | 0 |
| 37238 | 0 |
| 37239 | 0 |
| 37240 | 0 |
| 37241 | 0 |
| 37242 | 0 |
| 37243 | 1023 |
| 37244 | 1023 |
| 37245 | 1023 |
| 37246 | 1023 |
| 37247 | 1023 |
| 37248 | 1023 |
| 37249 | 1023 |
| 37250 | 1023 |
| 37251 | 1023 |
| 37252 | 1023 |
| 37253 | 1023 |
| 37254 | 1023 |
| 37255 | 1023 |
| 37256 | 1023 |
| 37257 | 1023 |
| 37258 | 1023 |
| 37259 | 1023 |
| 37260 | 1023 |
| 37261 | 1023 |
| 37262 | 1023 |
| 37263 | 1023 |
| 37264 | 1023 |
| 37265 | 1023 |
| 37266 | 1023 |
| 37267 | 1023 |
| 37268 | 1023 |
| 37269 | 1023 |
| 37270 | 1023 |
| 37271 | 1023 |
| 37272 | 1023 |
| 37273 | 1023 |
| 37274 | 1023 |
| 37275 | 1023 |
| 37276 | 1023 |
| 37277 | 1023 |
| 37278 | 1023 |
| 37279 | 1023 |
| 37280 | 1023 |
| 37281 | 0 |
| 37282 | 0 |
| 37283 | 0 |
| 37284 | 0 |
| 37285 | 0 |
| 37286 | 0 |
| 37287 | 0 |
| 37288 | 0 |
| 37289 | 0 |
| 37290 | 0 |
| 37291 | 0 |
| 37292 | 0 |
| 37293 | 0 |
| 37294 | 1023 |
| 37295 | 1023 |
| 37296 | 1023 |
| 37297 | 1023 |
| 37298 | 1023 |
| 37299 | 1023 |
| 37300 | 1023 |
| 37301 | 1023 |
| 37302 | 1023 |
| 37303 | 1023 |
| 37304 | 1023 |
| 37305 | 1023 |
| 37306 | 1023 |
| 37307 | 1023 |
| 37308 | 1023 |
| 37309 | 1023 |
| 37310 | 1023 |
| 37311 | 1023 |
| 37312 | 1023 |
| 37313 | 1023 |
| 37314 | 1023 |
| 37315 | 1023 |
| 37316 | 1023 |
| 37317 | 1023 |
| 37318 | 1023 |
| 37319 | 1023 |
| 37320 | 1023 |
| 37321 | 1023 |
| 37322 | 1023 |
| 37323 | 1023 |
| 37324 | 1023 |
| 37325 | 1023 |
| 37326 | 1023 |
| 37327 | 1023 |
| 37328 | 1023 |
| 37329 | 1023 |
| 37330 | 1023 |
| 37331 | 1023 |
| 37332 | 0 |
| 37333 | 0 |
| 37334 | 0 |
| 37335 | 0 |
| 37336 | 0 |
| 37337 | 0 |
| 37338 | 0 |
| 37339 | 0 |
| 37340 | 0 |
| 37341 | 0 |
| 37342 | 0 |
| 37343 | 0 |
| 37344 | 0 |
| 37345 | 1023 |
| 37346 | 1023 |
| 37347 | 1023 |
| 37348 | 1023 |
| 37349 | 1023 |
| 37350 | 1023 |
| 37351 | 1023 |
| 37352 | 1023 |
| 37353 | 1023 |
| 37354 | 1023 |
| 37355 | 1023 |
| 37356 | 1023 |
| 37357 | 1023 |
| 37358 | 1023 |
| 37359 | 1023 |
| 37360 | 1023 |
| 37361 | 1023 |
| 37362 | 1023 |
| 37363 | 1023 |
| 37364 | 1023 |
| 37365 | 1023 |
| 37366 | 1023 |
| 37367 | 1023 |
| 37368 | 1023 |
| 37369 | 1023 |
| 37370 | 1023 |
| 37371 | 1023 |
| 37372 | 1023 |
| 37373 | 1023 |
| 37374 | 1023 |
| 37375 | 1023 |
| 37376 | 1023 |
| 37377 | 1023 |
| 37378 | 1023 |
| 37379 | 1023 |
| 37380 | 1023 |
| 37381 | 1023 |
| 37382 | 1023 |
| 37383 | 0 |
| 37384 | 0 |
| 37385 | 0 |
| 37386 | 0 |
| 37387 | 0 |
| 37388 | 0 |
| 37389 | 0 |
| 37390 | 0 |
| 37391 | 0 |
| 37392 | 0 |
| 37393 | 0 |
| 37394 | 0 |
| 37395 | 0 |
| 37396 | 1023 |
| 37397 | 1023 |
| 37398 | 1023 |
| 37399 | 1023 |
| 37400 | 1023 |
| 37401 | 1023 |
| 37402 | 1023 |
| 37403 | 1023 |
| 37404 | 1023 |
| 37405 | 1023 |
| 37406 | 1023 |
| 37407 | 1023 |
| 37408 | 1023 |
| 37409 | 1023 |
| 37410 | 1023 |
| 37411 | 1023 |
| 37412 | 1023 |
| 37413 | 1023 |
| 37414 | 1023 |
| 37415 | 1023 |
| 37416 | 1023 |
| 37417 | 1023 |
| 37418 | 1023 |
| 37419 | 1023 |
| 37420 | 1023 |
| 37421 | 1023 |
| 37422 | 1023 |
| 37423 | 1023 |
| 37424 | 1023 |
| 37425 | 1023 |
| 37426 | 1023 |
| 37427 | 1023 |
| 37428 | 1023 |
| 37429 | 1023 |
| 37430 | 1023 |
| 37431 | 1023 |
| 37432 | 1023 |
| 37433 | 1023 |
| 37434 | 0 |
| 37435 | 0 |
| 37436 | 0 |
| 37437 | 0 |
| 37438 | 0 |
| 37439 | 0 |
| 37440 | 0 |
| 37441 | 0 |
| 37442 | 0 |
| 37443 | 0 |
| 37444 | 0 |
| 37445 | 0 |
| 37446 | 0 |
| 37447 | 1023 |
| 37448 | 1023 |
| 37449 | 1023 |
| 37450 | 1023 |
| 37451 | 1023 |
| 37452 | 1023 |
| 37453 | 1023 |
| 37454 | 1023 |
| 37455 | 1023 |
| 37456 | 1023 |
| 37457 | 1023 |
| 37458 | 1023 |
| 37459 | 1023 |
| 37460 | 1023 |
| 37461 | 1023 |
| 37462 | 1023 |
| 37463 | 1023 |
| 37464 | 1023 |
| 37465 | 1023 |
| 37466 | 1023 |
| 37467 | 1023 |
| 37468 | 1023 |
| 37469 | 1023 |
| 37470 | 1023 |
| 37471 | 1023 |
| 37472 | 1023 |
| 37473 | 1023 |
| 37474 | 1023 |
| 37475 | 1023 |
| 37476 | 1023 |
| 37477 | 1023 |
| 37478 | 1023 |
| 37479 | 1023 |
| 37480 | 1023 |
| 37481 | 1023 |
| 37482 | 1023 |
| 37483 | 1023 |
| 37484 | 1023 |
| 37485 | 0 |
| 37486 | 0 |
| 37487 | 0 |
| 37488 | 0 |
| 37489 | 1 |
| 37490 | 0 |
| 37491 | 0 |
| 37492 | 0 |
| 37493 | 0 |
| 37494 | 0 |
| 37495 | 0 |
| 37496 | 0 |
| 37497 | 0 |
| 37498 | 1023 |
| 37499 | 1023 |
| 37500 | 1023 |
| 37501 | 1023 |
| 37502 | 1023 |
| 37503 | 1023 |
| 37504 | 1023 |
| 37505 | 1023 |
| 37506 | 1023 |
| 37507 | 1023 |
| 37508 | 1023 |
| 37509 | 1023 |
| 37510 | 1023 |
| 37511 | 1023 |
| 37512 | 1023 |
| 37513 | 1023 |
| 37514 | 1023 |
| 37515 | 1023 |
| 37516 | 1023 |
| 37517 | 1023 |
| 37518 | 1023 |
| 37519 | 1023 |
| 37520 | 1023 |
| 37521 | 1023 |
| 37522 | 1023 |
| 37523 | 1023 |
| 37524 | 1023 |
| 37525 | 1023 |
| 37526 | 1023 |
| 37527 | 1023 |
| 37528 | 1023 |
| 37529 | 1023 |
| 37530 | 1023 |
| 37531 | 1023 |
| 37532 | 1023 |
| 37533 | 1023 |
| 37534 | 1023 |
| 37535 | 1023 |
| 37536 | 0 |
| 37537 | 0 |
| 37538 | 0 |
| 37539 | 0 |
| 37540 | 0 |
| 37541 | 0 |
| 37542 | 0 |
| 37543 | 0 |
| 37544 | 0 |
| 37545 | 0 |
| 37546 | 0 |
| 37547 | 0 |
| 37548 | 0 |
| 37549 | 0 |
| 37550 | 1023 |
| 37551 | 1023 |
| 37552 | 1023 |
| 37553 | 1023 |
| 37554 | 1023 |
| 37555 | 1023 |
| 37556 | 1023 |
| 37557 | 1023 |
| 37558 | 1023 |
| 37559 | 1023 |
| 37560 | 1023 |
| 37561 | 1023 |
| 37562 | 1023 |
| 37563 | 1023 |
| 37564 | 1023 |
| 37565 | 1023 |
| 37566 | 1023 |
| 37567 | 1023 |
| 37568 | 1023 |
| 37569 | 1023 |
| 37570 | 1023 |
| 37571 | 1023 |
| 37572 | 1023 |
| 37573 | 1023 |
| 37574 | 1023 |
| 37575 | 1023 |
| 37576 | 1023 |
| 37577 | 1023 |
| 37578 | 1023 |
| 37579 | 1023 |
| 37580 | 1023 |
| 37581 | 1023 |
| 37582 | 1023 |
| 37583 | 1023 |
| 37584 | 1023 |
| 37585 | 1023 |
| 37586 | 1023 |
| 37587 | 0 |
| 37588 | 0 |
| 37589 | 1 |
| 37590 | 0 |
| 37591 | 0 |
| 37592 | 0 |
| 37593 | 0 |
| 37594 | 0 |
| 37595 | 0 |
| 37596 | 0 |
| 37597 | 0 |
| 37598 | 0 |
| 37599 | 0 |
| 37600 | 0 |
| 37601 | 1023 |
| 37602 | 1023 |
| 37603 | 1023 |
| 37604 | 1023 |
| 37605 | 1023 |
| 37606 | 1023 |
| 37607 | 1023 |
| 37608 | 1023 |
| 37609 | 1023 |
| 37610 | 1023 |
| 37611 | 1023 |
| 37612 | 1023 |
| 37613 | 1023 |
| 37614 | 1023 |
| 37615 | 1023 |
| 37616 | 1023 |
| 37617 | 1023 |
| 37618 | 1023 |
| 37619 | 1023 |
| 37620 | 1023 |
| 37621 | 1023 |
| 37622 | 1023 |
| 37623 | 1023 |
| 37624 | 1023 |
| 37625 | 1023 |
| 37626 | 1023 |
| 37627 | 1023 |
| 37628 | 1023 |
| 37629 | 1023 |
| 37630 | 1023 |
| 37631 | 1023 |
| 37632 | 1023 |
| 37633 | 1023 |
| 37634 | 1023 |
| 37635 | 1023 |
| 37636 | 1023 |
| 37637 | 1023 |
| 37638 | 1023 |
| 37639 | 0 |
| 37640 | 0 |
| 37641 | 0 |
| 37642 | 0 |
| 37643 | 0 |
| 37644 | 0 |
| 37645 | 0 |
| 37646 | 0 |
| 37647 | 0 |
| 37648 | 0 |
| 37649 | 0 |
| 37650 | 0 |
| 37651 | 0 |
| 37652 | 0 |
| 37653 | 1023 |
| 37654 | 1023 |
| 37655 | 1023 |
| 37656 | 1023 |
| 37657 | 1023 |
| 37658 | 1023 |
| 37659 | 1023 |
| 37660 | 1023 |
| 37661 | 1023 |
| 37662 | 1023 |
| 37663 | 1023 |
| 37664 | 1023 |
| 37665 | 1023 |
| 37666 | 1023 |
| 37667 | 1023 |
| 37668 | 1023 |
| 37669 | 1023 |
| 37670 | 1023 |
| 37671 | 1023 |
| 37672 | 1023 |
| 37673 | 1023 |
| 37674 | 1023 |
| 37675 | 1023 |
| 37676 | 1023 |
| 37677 | 1023 |
| 37678 | 1023 |
| 37679 | 1023 |
| 37680 | 1023 |
| 37681 | 1023 |
| 37682 | 1023 |
| 37683 | 1023 |
| 37684 | 1023 |
| 37685 | 1023 |
| 37686 | 1023 |
| 37687 | 1023 |
| 37688 | 1023 |
| 37689 | 1023 |
| 37690 | 0 |
| 37691 | 0 |
| 37692 | 0 |
| 37693 | 0 |
| 37694 | 0 |
| 37695 | 0 |
| 37696 | 0 |
| 37697 | 0 |
| 37698 | 0 |
| 37699 | 0 |
| 37700 | 0 |
| 37701 | 0 |
| 37702 | 0 |
| 37703 | 0 |
| 37704 | 0 |
| 37705 | 1023 |
| 37706 | 1023 |
| 37707 | 1023 |
| 37708 | 1023 |
| 37709 | 1023 |
| 37710 | 1023 |
| 37711 | 1023 |
| 37712 | 1023 |
| 37713 | 1023 |
| 37714 | 1023 |
| 37715 | 1023 |
| 37716 | 1023 |
| 37717 | 1023 |
| 37718 | 1023 |
| 37719 | 1023 |
| 37720 | 1023 |
| 37721 | 1023 |
| 37722 | 1023 |
| 37723 | 1023 |
| 37724 | 1023 |
| 37725 | 1023 |
| 37726 | 1023 |
| 37727 | 1023 |
| 37728 | 1023 |
| 37729 | 1023 |
| 37730 | 1023 |
| 37731 | 1023 |
| 37732 | 1023 |
| 37733 | 1023 |
| 37734 | 1023 |
| 37735 | 1023 |
| 37736 | 1023 |
| 37737 | 1023 |
| 37738 | 1023 |
| 37739 | 1023 |
| 37740 | 1023 |
| 37741 | 1023 |
| 37742 | 0 |
| 37743 | 0 |
| 37744 | 0 |
| 37745 | 0 |
| 37746 | 0 |
| 37747 | 0 |
| 37748 | 0 |
| 37749 | 0 |
| 37750 | 0 |
| 37751 | 0 |
| 37752 | 0 |
| 37753 | 0 |
| 37754 | 0 |
| 37755 | 0 |
| 37756 | 0 |
| 37757 | 1023 |
| 37758 | 1023 |
| 37759 | 1023 |
| 37760 | 1023 |
| 37761 | 1023 |
| 37762 | 1023 |
| 37763 | 1023 |
| 37764 | 1023 |
| 37765 | 1023 |
| 37766 | 1023 |
| 37767 | 1023 |
| 37768 | 1023 |
| 37769 | 1023 |
| 37770 | 1023 |
| 37771 | 1023 |
| 37772 | 1023 |
| 37773 | 1023 |
| 37774 | 1023 |
| 37775 | 1023 |
| 37776 | 1023 |
| 37777 | 1023 |
| 37778 | 1023 |
| 37779 | 1023 |
| 37780 | 1023 |
| 37781 | 1023 |
| 37782 | 1023 |
| 37783 | 1023 |
| 37784 | 1023 |
| 37785 | 1023 |
| 37786 | 1023 |
| 37787 | 1023 |
| 37788 | 1023 |
| 37789 | 1023 |
| 37790 | 1023 |
| 37791 | 1023 |
| 37792 | 1023 |
| 37793 | 1023 |
| 37794 | 1023 |
| 37795 | 0 |
| 37796 | 0 |
| 37797 | 0 |
| 37798 | 0 |
| 37799 | 0 |
| 37800 | 0 |
| 37801 | 0 |
| 37802 | 0 |
| 37803 | 0 |
| 37804 | 0 |
| 37805 | 0 |
| 37806 | 0 |
| 37807 | 0 |
| 37808 | 1023 |
| 37809 | 1023 |
| 37810 | 1023 |
| 37811 | 1023 |
| 37812 | 1023 |
| 37813 | 1023 |
| 37814 | 1023 |
| 37815 | 1023 |
| 37816 | 1023 |
| 37817 | 1023 |
| 37818 | 1023 |
| 37819 | 1023 |
| 37820 | 1023 |
| 37821 | 1023 |
| 37822 | 1023 |
| 37823 | 1023 |
| 37824 | 1023 |
| 37825 | 1023 |
| 37826 | 1023 |
| 37827 | 1023 |
| 37828 | 1023 |
| 37829 | 1023 |
| 37830 | 1023 |
| 37831 | 1023 |
| 37832 | 1023 |
| 37833 | 1023 |
| 37834 | 1023 |
| 37835 | 1023 |
| 37836 | 1023 |
| 37837 | 1023 |
| 37838 | 1023 |
| 37839 | 1023 |
| 37840 | 1023 |
| 37841 | 1023 |
| 37842 | 1023 |
| 37843 | 1023 |
| 37844 | 1023 |
| 37845 | 1023 |
| 37846 | 0 |
| 37847 | 0 |
| 37848 | 0 |
| 37849 | 0 |
| 37850 | 0 |
| 37851 | 0 |
| 37852 | 0 |
| 37853 | 0 |
| 37854 | 0 |
| 37855 | 0 |
| 37856 | 0 |
| 37857 | 0 |
| 37858 | 0 |
| 37859 | 1023 |
| 37860 | 1023 |
| 37861 | 1023 |
| 37862 | 1023 |
| 37863 | 1023 |
| 37864 | 1023 |
| 37865 | 1023 |
| 37866 | 1023 |
| 37867 | 1023 |
| 37868 | 1023 |
| 37869 | 1023 |
| 37870 | 1023 |
| 37871 | 1023 |
| 37872 | 1023 |
| 37873 | 1023 |
| 37874 | 1023 |
| 37875 | 1023 |
| 37876 | 1023 |
| 37877 | 1023 |
| 37878 | 1023 |
| 37879 | 1023 |
| 37880 | 1023 |
| 37881 | 1023 |
| 37882 | 1023 |
| 37883 | 1023 |
| 37884 | 1023 |
| 37885 | 1023 |
| 37886 | 1023 |
| 37887 | 1023 |
| 37888 | 1023 |
| 37889 | 1023 |
| 37890 | 1023 |
| 37891 | 1023 |
| 37892 | 1023 |
| 37893 | 1023 |
| 37894 | 1023 |
| 37895 | 1023 |
| 37896 | 1023 |
| 37897 | 0 |
| 37898 | 0 |
| 37899 | 0 |
| 37900 | 0 |
| 37901 | 0 |
| 37902 | 0 |
| 37903 | 0 |
| 37904 | 0 |
| 37905 | 0 |
| 37906 | 0 |
| 37907 | 1 |
| 37908 | 0 |
| 37909 | 0 |
| 37910 | 1023 |
| 37911 | 1023 |
| 37912 | 1023 |
| 37913 | 1023 |
| 37914 | 1023 |
| 37915 | 1023 |
| 37916 | 1023 |
| 37917 | 1023 |
| 37918 | 1023 |
| 37919 | 1023 |
| 37920 | 1023 |
| 37921 | 1023 |
| 37922 | 1023 |
| 37923 | 1023 |
| 37924 | 1023 |
| 37925 | 1023 |
| 37926 | 1023 |
| 37927 | 1023 |
| 37928 | 1023 |
| 37929 | 1023 |
| 37930 | 1023 |
| 37931 | 1023 |
| 37932 | 1023 |
| 37933 | 1023 |
| 37934 | 1023 |
| 37935 | 1023 |
| 37936 | 1023 |
| 37937 | 1023 |
| 37938 | 1023 |
| 37939 | 1023 |
| 37940 | 1023 |
| 37941 | 1023 |
| 37942 | 1023 |
| 37943 | 1023 |
| 37944 | 1023 |
| 37945 | 1023 |
| 37946 | 1023 |
| 37947 | 1023 |
| 37948 | 0 |
| 37949 | 0 |
| 37950 | 0 |
| 37951 | 0 |
| 37952 | 0 |
| 37953 | 0 |
| 37954 | 0 |
| 37955 | 0 |
| 37956 | 0 |
| 37957 | 0 |
| 37958 | 0 |
| 37959 | 0 |
| 37960 | 0 |
| 37961 | 1023 |
| 37962 | 1023 |
| 37963 | 1023 |
| 37964 | 1023 |
| 37965 | 1023 |
| 37966 | 1023 |
| 37967 | 1023 |
| 37968 | 1023 |
| 37969 | 1023 |
| 37970 | 1023 |
| 37971 | 1023 |
| 37972 | 1023 |
| 37973 | 1023 |
| 37974 | 1023 |
| 37975 | 1023 |
| 37976 | 1023 |
| 37977 | 1023 |
| 37978 | 1023 |
| 37979 | 1023 |
| 37980 | 1023 |
| 37981 | 1023 |
| 37982 | 1023 |
| 37983 | 1023 |
| 37984 | 1023 |
| 37985 | 1023 |
| 37986 | 1023 |
| 37987 | 1023 |
| 37988 | 1023 |
| 37989 | 1023 |
| 37990 | 1023 |
| 37991 | 1023 |
| 37992 | 1023 |
| 37993 | 1023 |
| 37994 | 1023 |
| 37995 | 1023 |
| 37996 | 1023 |
| 37997 | 1023 |
| 37998 | 1023 |
| 37999 | 0 |
| 38000 | 0 |
| 38001 | 0 |
| 38002 | 0 |
| 38003 | 0 |
| 38004 | 0 |
| 38005 | 0 |
| 38006 | 0 |
| 38007 | 0 |
| 38008 | 0 |
| 38009 | 0 |
| 38010 | 0 |
| 38011 | 0 |
| 38012 | 1023 |
| 38013 | 1023 |
| 38014 | 1023 |
| 38015 | 1023 |
| 38016 | 1023 |
| 38017 | 1023 |
| 38018 | 1023 |
| 38019 | 1023 |
| 38020 | 1023 |
| 38021 | 1023 |
| 38022 | 1023 |
| 38023 | 1023 |
| 38024 | 1023 |
| 38025 | 1023 |
| 38026 | 1023 |
| 38027 | 1023 |
| 38028 | 1023 |
| 38029 | 1023 |
| 38030 | 1023 |
| 38031 | 1023 |
| 38032 | 1023 |
| 38033 | 1023 |
| 38034 | 1023 |
| 38035 | 1023 |
| 38036 | 1023 |
| 38037 | 1023 |
| 38038 | 1023 |
| 38039 | 1023 |
| 38040 | 1023 |
| 38041 | 1023 |
| 38042 | 1023 |
| 38043 | 1023 |
| 38044 | 1023 |
| 38045 | 1023 |
| 38046 | 1023 |
| 38047 | 1023 |
| 38048 | 1023 |
| 38049 | 1023 |
| 38050 | 0 |
| 38051 | 0 |
| 38052 | 0 |
| 38053 | 0 |
| 38054 | 0 |
| 38055 | 0 |
| 38056 | 0 |
| 38057 | 0 |
| 38058 | 0 |
| 38059 | 0 |
| 38060 | 0 |
| 38061 | 0 |
| 38062 | 0 |
| 38063 | 1023 |
| 38064 | 1023 |
| 38065 | 1023 |
| 38066 | 1023 |
| 38067 | 1023 |
| 38068 | 1023 |
| 38069 | 1023 |
| 38070 | 1023 |
| 38071 | 1023 |
| 38072 | 1023 |
| 38073 | 1023 |
| 38074 | 1023 |
| 38075 | 1023 |
| 38076 | 1023 |
| 38077 | 1023 |
| 38078 | 1023 |
| 38079 | 1023 |
| 38080 | 1023 |
| 38081 | 1023 |
| 38082 | 1023 |
| 38083 | 1023 |
| 38084 | 1023 |
| 38085 | 1023 |
| 38086 | 1023 |
| 38087 | 1023 |
| 38088 | 1023 |
| 38089 | 1023 |
| 38090 | 1023 |
| 38091 | 1023 |
| 38092 | 1023 |
| 38093 | 1023 |
| 38094 | 1023 |
| 38095 | 1023 |
| 38096 | 1023 |
| 38097 | 1023 |
| 38098 | 1023 |
| 38099 | 1023 |
| 38100 | 1023 |
| 38101 | 0 |
| 38102 | 0 |
| 38103 | 0 |
| 38104 | 0 |
| 38105 | 0 |
| 38106 | 0 |
| 38107 | 0 |
| 38108 | 0 |
| 38109 | 0 |
| 38110 | 0 |
| 38111 | 0 |
| 38112 | 0 |
| 38113 | 0 |
| 38114 | 1023 |
| 38115 | 1023 |
| 38116 | 1023 |
| 38117 | 1023 |
| 38118 | 1023 |
| 38119 | 1023 |
| 38120 | 1023 |
| 38121 | 1023 |
| 38122 | 1023 |
| 38123 | 1023 |
| 38124 | 1023 |
| 38125 | 1023 |
| 38126 | 1023 |
| 38127 | 1023 |
| 38128 | 1023 |
| 38129 | 1023 |
| 38130 | 1023 |
| 38131 | 1023 |
| 38132 | 1023 |
| 38133 | 1023 |
| 38134 | 1023 |
| 38135 | 1023 |
| 38136 | 1023 |
| 38137 | 1023 |
| 38138 | 1023 |
| 38139 | 1023 |
| 38140 | 1023 |
| 38141 | 1023 |
| 38142 | 1023 |
| 38143 | 1023 |
| 38144 | 1023 |
| 38145 | 1023 |
| 38146 | 1023 |
| 38147 | 1023 |
| 38148 | 1023 |
| 38149 | 1023 |
| 38150 | 1023 |
| 38151 | 1023 |
| 38152 | 0 |
| 38153 | 0 |
| 38154 | 0 |
| 38155 | 0 |
| 38156 | 0 |
| 38157 | 0 |
| 38158 | 0 |
| 38159 | 0 |
| 38160 | 0 |
| 38161 | 0 |
| 38162 | 0 |
| 38163 | 0 |
| 38164 | 0 |
| 38165 | 0 |
| 38166 | 1023 |
| 38167 | 1023 |
| 38168 | 1023 |
| 38169 | 1023 |
| 38170 | 1023 |
| 38171 | 1023 |
| 38172 | 1023 |
| 38173 | 1023 |
| 38174 | 1023 |
| 38175 | 1023 |
| 38176 | 1023 |
| 38177 | 1023 |
| 38178 | 1023 |
| 38179 | 1023 |
| 38180 | 1023 |
| 38181 | 1023 |
| 38182 | 1023 |
| 38183 | 1023 |
| 38184 | 1023 |
| 38185 | 1023 |
| 38186 | 1023 |
| 38187 | 1023 |
| 38188 | 1023 |
| 38189 | 1023 |
| 38190 | 1023 |
| 38191 | 1023 |
| 38192 | 1023 |
| 38193 | 1023 |
| 38194 | 1023 |
| 38195 | 1023 |
| 38196 | 1023 |
| 38197 | 1023 |
| 38198 | 1023 |
| 38199 | 1023 |
| 38200 | 1023 |
| 38201 | 1023 |
| 38202 | 1023 |
| 38203 | 0 |
| 38204 | 0 |
| 38205 | 0 |
| 38206 | 0 |
| 38207 | 0 |
| 38208 | 0 |
| 38209 | 0 |
| 38210 | 0 |
| 38211 | 0 |
| 38212 | 0 |
| 38213 | 0 |
| 38214 | 0 |
| 38215 | 0 |
| 38216 | 0 |
| 38217 | 1023 |
| 38218 | 1023 |
| 38219 | 1023 |
| 38220 | 1023 |
| 38221 | 1023 |
| 38222 | 1023 |
| 38223 | 1023 |
| 38224 | 1023 |
| 38225 | 1023 |
| 38226 | 1023 |
| 38227 | 1023 |
| 38228 | 1023 |
| 38229 | 1023 |
| 38230 | 1023 |
| 38231 | 1023 |
| 38232 | 1023 |
| 38233 | 1023 |
| 38234 | 1023 |
| 38235 | 1023 |
| 38236 | 1023 |
| 38237 | 1023 |
| 38238 | 1023 |
| 38239 | 1023 |
| 38240 | 1023 |
| 38241 | 1023 |
| 38242 | 1023 |
| 38243 | 1023 |
| 38244 | 1023 |
| 38245 | 1023 |
| 38246 | 1023 |
| 38247 | 1023 |
| 38248 | 1023 |
| 38249 | 1023 |
| 38250 | 1023 |
| 38251 | 1023 |
| 38252 | 1023 |
| 38253 | 1023 |
| 38254 | 1023 |
| 38255 | 0 |
| 38256 | 0 |
| 38257 | 0 |
| 38258 | 0 |
| 38259 | 0 |
| 38260 | 0 |
| 38261 | 0 |
| 38262 | 0 |
| 38263 | 0 |
| 38264 | 0 |
| 38265 | 0 |
| 38266 | 0 |
| 38267 | 0 |
| 38268 | 0 |
| 38269 | 1023 |
| 38270 | 1023 |
| 38271 | 1023 |
| 38272 | 1023 |
| 38273 | 1023 |
| 38274 | 1023 |
| 38275 | 1023 |
| 38276 | 1023 |
| 38277 | 1023 |
| 38278 | 1023 |
| 38279 | 1023 |
| 38280 | 1023 |
| 38281 | 1023 |
| 38282 | 1023 |
| 38283 | 1023 |
| 38284 | 1023 |
| 38285 | 1023 |
| 38286 | 1023 |
| 38287 | 1023 |
| 38288 | 1023 |
| 38289 | 1023 |
| 38290 | 1023 |
| 38291 | 1023 |
| 38292 | 1023 |
| 38293 | 1023 |
| 38294 | 1023 |
| 38295 | 1023 |
| 38296 | 1023 |
| 38297 | 1023 |
| 38298 | 1023 |
| 38299 | 1023 |
| 38300 | 1023 |
| 38301 | 1023 |
| 38302 | 1023 |
| 38303 | 1023 |
| 38304 | 1023 |
| 38305 | 1023 |
| 38306 | 0 |
| 38307 | 0 |
| 38308 | 0 |
| 38309 | 0 |
| 38310 | 0 |
| 38311 | 0 |
| 38312 | 0 |
| 38313 | 0 |
| 38314 | 0 |
| 38315 | 0 |
| 38316 | 0 |
| 38317 | 0 |
| 38318 | 0 |
| 38319 | 0 |
| 38320 | 0 |
| 38321 | 1023 |
| 38322 | 1023 |
| 38323 | 1023 |
| 38324 | 1023 |
| 38325 | 1023 |
| 38326 | 1023 |
| 38327 | 1023 |
| 38328 | 1023 |
| 38329 | 1023 |
| 38330 | 1023 |
| 38331 | 1023 |
| 38332 | 1023 |
| 38333 | 1023 |
| 38334 | 1023 |
| 38335 | 1023 |
| 38336 | 1023 |
| 38337 | 1023 |
| 38338 | 1023 |
| 38339 | 1023 |
| 38340 | 1023 |
| 38341 | 1023 |
| 38342 | 1023 |
| 38343 | 1023 |
| 38344 | 1023 |
| 38345 | 1023 |
| 38346 | 1023 |
| 38347 | 1023 |
| 38348 | 1023 |
| 38349 | 1023 |
| 38350 | 1023 |
| 38351 | 1023 |
| 38352 | 1023 |
| 38353 | 1023 |
| 38354 | 1023 |
| 38355 | 1023 |
| 38356 | 1023 |
| 38357 | 1023 |
| 38358 | 0 |
| 38359 | 0 |
| 38360 | 0 |
| 38361 | 0 |
| 38362 | 0 |
| 38363 | 0 |
| 38364 | 0 |
| 38365 | 0 |
| 38366 | 0 |
| 38367 | 0 |
| 38368 | 0 |
| 38369 | 0 |
| 38370 | 0 |
| 38371 | 0 |
| 38372 | 0 |
| 38373 | 1023 |
| 38374 | 1023 |
| 38375 | 1023 |
| 38376 | 1023 |
| 38377 | 1023 |
| 38378 | 1023 |
| 38379 | 1023 |
| 38380 | 1023 |
| 38381 | 1023 |
| 38382 | 1023 |
| 38383 | 1023 |
| 38384 | 1023 |
| 38385 | 1023 |
| 38386 | 1023 |
| 38387 | 1023 |
| 38388 | 1023 |
| 38389 | 1023 |
| 38390 | 1023 |
| 38391 | 1023 |
| 38392 | 1023 |
| 38393 | 1023 |
| 38394 | 1023 |
| 38395 | 1023 |
| 38396 | 1023 |
| 38397 | 1023 |
| 38398 | 1023 |
| 38399 | 1023 |
| 38400 | 1023 |
| 38401 | 1023 |
| 38402 | 1023 |
| 38403 | 1023 |
| 38404 | 1023 |
| 38405 | 1023 |
| 38406 | 1023 |
| 38407 | 1023 |
| 38408 | 1023 |
| 38409 | 1023 |
| 38410 | 1023 |
| 38411 | 0 |
| 38412 | 0 |
| 38413 | 0 |
| 38414 | 0 |
| 38415 | 0 |
| 38416 | 0 |
| 38417 | 0 |
| 38418 | 0 |
| 38419 | 0 |
| 38420 | 0 |
| 38421 | 0 |
| 38422 | 0 |
| 38423 | 0 |
| 38424 | 1023 |
| 38425 | 1023 |
| 38426 | 1023 |
| 38427 | 1023 |
| 38428 | 1023 |
| 38429 | 1023 |
| 38430 | 1023 |
| 38431 | 1023 |
| 38432 | 1023 |
| 38433 | 1023 |
| 38434 | 1023 |
| 38435 | 1023 |
| 38436 | 1023 |
| 38437 | 1023 |
| 38438 | 1023 |
| 38439 | 1023 |
| 38440 | 1023 |
| 38441 | 1023 |
| 38442 | 1023 |
| 38443 | 1023 |
| 38444 | 1023 |
| 38445 | 1023 |
| 38446 | 1023 |
| 38447 | 1023 |
| 38448 | 1023 |
| 38449 | 1023 |
| 38450 | 1023 |
| 38451 | 1023 |
| 38452 | 1023 |
| 38453 | 1023 |
| 38454 | 1023 |
| 38455 | 1023 |
| 38456 | 1023 |
| 38457 | 1023 |
| 38458 | 1023 |
| 38459 | 1023 |
| 38460 | 1023 |
| 38461 | 1023 |
| 38462 | 0 |
| 38463 | 0 |
| 38464 | 0 |
| 38465 | 0 |
| 38466 | 0 |
| 38467 | 0 |
| 38468 | 0 |
| 38469 | 0 |
| 38470 | 0 |
| 38471 | 0 |
| 38472 | 0 |
| 38473 | 0 |
| 38474 | 0 |
| 38475 | 1023 |
| 38476 | 1023 |
| 38477 | 1023 |
| 38478 | 1023 |
| 38479 | 1023 |
| 38480 | 1023 |
| 38481 | 1023 |
| 38482 | 1023 |
| 38483 | 1023 |
| 38484 | 1023 |
| 38485 | 1023 |
| 38486 | 1023 |
| 38487 | 1023 |
| 38488 | 1023 |
| 38489 | 1023 |
| 38490 | 1023 |
| 38491 | 1023 |
| 38492 | 1023 |
| 38493 | 1023 |
| 38494 | 1023 |
| 38495 | 1023 |
| 38496 | 1023 |
| 38497 | 1023 |
| 38498 | 1023 |
| 38499 | 1023 |
| 38500 | 1023 |
| 38501 | 1023 |
| 38502 | 1023 |
| 38503 | 1023 |
| 38504 | 1023 |
| 38505 | 1023 |
| 38506 | 1023 |
| 38507 | 1023 |
| 38508 | 1023 |
| 38509 | 1023 |
| 38510 | 1023 |
| 38511 | 1023 |
| 38512 | 1023 |
| 38513 | 0 |
| 38514 | 0 |
| 38515 | 0 |
| 38516 | 0 |
| 38517 | 0 |
| 38518 | 0 |
| 38519 | 0 |
| 38520 | 0 |
| 38521 | 0 |
| 38522 | 0 |
| 38523 | 0 |
| 38524 | 0 |
| 38525 | 0 |
| 38526 | 1023 |
| 38527 | 1023 |
| 38528 | 1023 |
| 38529 | 1023 |
| 38530 | 1023 |
| 38531 | 1023 |
| 38532 | 1023 |
| 38533 | 1023 |
| 38534 | 1023 |
| 38535 | 1023 |
| 38536 | 1023 |
| 38537 | 1023 |
| 38538 | 1023 |
| 38539 | 1023 |
| 38540 | 1023 |
| 38541 | 1023 |
| 38542 | 1023 |
| 38543 | 1023 |
| 38544 | 1023 |
| 38545 | 1023 |
| 38546 | 1023 |
| 38547 | 1023 |
| 38548 | 1023 |
| 38549 | 1023 |
| 38550 | 1023 |
| 38551 | 1023 |
| 38552 | 1023 |
| 38553 | 1023 |
| 38554 | 1023 |
| 38555 | 1023 |
| 38556 | 1023 |
| 38557 | 1023 |
| 38558 | 1023 |
| 38559 | 1023 |
| 38560 | 1023 |
| 38561 | 1023 |
| 38562 | 1023 |
| 38563 | 1023 |
| 38564 | 0 |
| 38565 | 0 |
| 38566 | 0 |
| 38567 | 1 |
| 38568 | 1 |
| 38569 | 0 |
| 38570 | 0 |
| 38571 | 0 |
| 38572 | 0 |
| 38573 | 0 |
| 38574 | 0 |
| 38575 | 0 |
| 38576 | 0 |
| 38577 | 1023 |
| 38578 | 1023 |
| 38579 | 1023 |
| 38580 | 1023 |
| 38581 | 1023 |
| 38582 | 1023 |
| 38583 | 1023 |
| 38584 | 1023 |
| 38585 | 1023 |
| 38586 | 1023 |
| 38587 | 1023 |
| 38588 | 1023 |
| 38589 | 1023 |
| 38590 | 1023 |
| 38591 | 1023 |
| 38592 | 1023 |
| 38593 | 1023 |
| 38594 | 1023 |
| 38595 | 1023 |
| 38596 | 1023 |
| 38597 | 1023 |
| 38598 | 1023 |
| 38599 | 1023 |
| 38600 | 1023 |
| 38601 | 1023 |
| 38602 | 1023 |
| 38603 | 1023 |
| 38604 | 1023 |
| 38605 | 1023 |
| 38606 | 1023 |
| 38607 | 1023 |
| 38608 | 1023 |
| 38609 | 1023 |
| 38610 | 1023 |
| 38611 | 1023 |
| 38612 | 1023 |
| 38613 | 1023 |
| 38614 | 1023 |
| 38615 | 0 |
| 38616 | 0 |
| 38617 | 0 |
| 38618 | 0 |
| 38619 | 0 |
| 38620 | 0 |
| 38621 | 0 |
| 38622 | 0 |
| 38623 | 0 |
| 38624 | 0 |
| 38625 | 0 |
| 38626 | 0 |
| 38627 | 0 |
| 38628 | 1023 |
| 38629 | 1023 |
| 38630 | 1023 |
| 38631 | 1023 |
| 38632 | 1023 |
| 38633 | 1023 |
| 38634 | 1023 |
| 38635 | 1023 |
| 38636 | 1023 |
| 38637 | 1023 |
| 38638 | 1023 |
| 38639 | 1023 |
| 38640 | 1023 |
| 38641 | 1023 |
| 38642 | 1023 |
| 38643 | 1023 |
| 38644 | 1023 |
| 38645 | 1023 |
| 38646 | 1023 |
| 38647 | 1023 |
| 38648 | 1023 |
| 38649 | 1023 |
| 38650 | 1023 |
| 38651 | 1023 |
| 38652 | 1023 |
| 38653 | 1023 |
| 38654 | 1023 |
| 38655 | 1023 |
| 38656 | 1023 |
| 38657 | 1023 |
| 38658 | 1023 |
| 38659 | 1023 |
| 38660 | 1023 |
| 38661 | 1023 |
| 38662 | 1023 |
| 38663 | 1023 |
| 38664 | 1023 |
| 38665 | 1023 |
| 38666 | 0 |
| 38667 | 0 |
| 38668 | 0 |
| 38669 | 0 |
| 38670 | 0 |
| 38671 | 0 |
| 38672 | 0 |
| 38673 | 0 |
| 38674 | 0 |
| 38675 | 0 |
| 38676 | 0 |
| 38677 | 0 |
| 38678 | 0 |
| 38679 | 1023 |
| 38680 | 1023 |
| 38681 | 1023 |
| 38682 | 1023 |
| 38683 | 1023 |
| 38684 | 1023 |
| 38685 | 1023 |
| 38686 | 1023 |
| 38687 | 1023 |
| 38688 | 1023 |
| 38689 | 1023 |
| 38690 | 1023 |
| 38691 | 1023 |
| 38692 | 1023 |
| 38693 | 1023 |
| 38694 | 1023 |
| 38695 | 1023 |
| 38696 | 1023 |
| 38697 | 1023 |
| 38698 | 1023 |
| 38699 | 1023 |
| 38700 | 1023 |
| 38701 | 1023 |
| 38702 | 1023 |
| 38703 | 1023 |
| 38704 | 1023 |
| 38705 | 1023 |
| 38706 | 1023 |
| 38707 | 1023 |
| 38708 | 1023 |
| 38709 | 1023 |
| 38710 | 1023 |
| 38711 | 1023 |
| 38712 | 1023 |
| 38713 | 1023 |
| 38714 | 1023 |
| 38715 | 1023 |
| 38716 | 1023 |
| 38717 | 0 |
| 38718 | 0 |
| 38719 | 0 |
| 38720 | 0 |
| 38721 | 0 |
| 38722 | 0 |
| 38723 | 0 |
| 38724 | 0 |
| 38725 | 0 |
| 38726 | 0 |
| 38727 | 0 |
| 38728 | 0 |
| 38729 | 0 |
| 38730 | 0 |
| 38731 | 1023 |
| 38732 | 1023 |
| 38733 | 1023 |
| 38734 | 1023 |
| 38735 | 1023 |
| 38736 | 1023 |
| 38737 | 1023 |
| 38738 | 1023 |
| 38739 | 1023 |
| 38740 | 1023 |
| 38741 | 1023 |
| 38742 | 1023 |
| 38743 | 1023 |
| 38744 | 1023 |
| 38745 | 1023 |
| 38746 | 1023 |
| 38747 | 1023 |
| 38748 | 1023 |
| 38749 | 1023 |
| 38750 | 1023 |
| 38751 | 1023 |
| 38752 | 1023 |
| 38753 | 1023 |
| 38754 | 1023 |
| 38755 | 1023 |
| 38756 | 1023 |
| 38757 | 1023 |
| 38758 | 1023 |
| 38759 | 1023 |
| 38760 | 1023 |
| 38761 | 1023 |
| 38762 | 1023 |
| 38763 | 1023 |
| 38764 | 1023 |
| 38765 | 1023 |
| 38766 | 1023 |
| 38767 | 1023 |
| 38768 | 0 |
| 38769 | 0 |
| 38770 | 0 |
| 38771 | 0 |
| 38772 | 0 |
| 38773 | 0 |
| 38774 | 0 |
| 38775 | 0 |
| 38776 | 0 |
| 38777 | 0 |
| 38778 | 0 |
| 38779 | 0 |
| 38780 | 0 |
| 38781 | 0 |
| 38782 | 1023 |
| 38783 | 1023 |
| 38784 | 1023 |
| 38785 | 1023 |
| 38786 | 1023 |
| 38787 | 1023 |
| 38788 | 1023 |
| 38789 | 1023 |
| 38790 | 1023 |
| 38791 | 1023 |
| 38792 | 1023 |
| 38793 | 1023 |
| 38794 | 1023 |
| 38795 | 1023 |
| 38796 | 1023 |
| 38797 | 1023 |
| 38798 | 1023 |
| 38799 | 1023 |
| 38800 | 1023 |
| 38801 | 1023 |
| 38802 | 1023 |
| 38803 | 1023 |
| 38804 | 1023 |
| 38805 | 1023 |
| 38806 | 1023 |
| 38807 | 1023 |
| 38808 | 1023 |
| 38809 | 1023 |
| 38810 | 1023 |
| 38811 | 1023 |
| 38812 | 1023 |
| 38813 | 1023 |
| 38814 | 1023 |
| 38815 | 1023 |
| 38816 | 1023 |
| 38817 | 1023 |
| 38818 | 1023 |
| 38819 | 1023 |
| 38820 | 0 |
| 38821 | 0 |
| 38822 | 0 |
| 38823 | 0 |
| 38824 | 0 |
| 38825 | 0 |
| 38826 | 0 |
| 38827 | 0 |
| 38828 | 0 |
| 38829 | 0 |
| 38830 | 0 |
| 38831 | 0 |
| 38832 | 0 |
| 38833 | 0 |
| 38834 | 1023 |
| 38835 | 1023 |
| 38836 | 1023 |
| 38837 | 1023 |
| 38838 | 1023 |
| 38839 | 1023 |
| 38840 | 1023 |
| 38841 | 1023 |
| 38842 | 1023 |
| 38843 | 1023 |
| 38844 | 1023 |
| 38845 | 1023 |
| 38846 | 1023 |
| 38847 | 1023 |
| 38848 | 1023 |
| 38849 | 1023 |
| 38850 | 1023 |
| 38851 | 1023 |
| 38852 | 1023 |
| 38853 | 1023 |
| 38854 | 1023 |
| 38855 | 1023 |
| 38856 | 1023 |
| 38857 | 1023 |
| 38858 | 1023 |
| 38859 | 1023 |
| 38860 | 1023 |
| 38861 | 1023 |
| 38862 | 1023 |
| 38863 | 1023 |
| 38864 | 1023 |
| 38865 | 1023 |
| 38866 | 1023 |
| 38867 | 1023 |
| 38868 | 1023 |
| 38869 | 1023 |
| 38870 | 1023 |
| 38871 | 0 |
| 38872 | 0 |
| 38873 | 0 |
| 38874 | 0 |
| 38875 | 0 |
| 38876 | 0 |
| 38877 | 0 |
| 38878 | 0 |
| 38879 | 0 |
| 38880 | 0 |
| 38881 | 0 |
| 38882 | 0 |
| 38883 | 0 |
| 38884 | 0 |
| 38885 | 0 |
| 38886 | 1023 |
| 38887 | 1023 |
| 38888 | 1023 |
| 38889 | 1023 |
| 38890 | 1023 |
| 38891 | 1023 |
| 38892 | 1023 |
| 38893 | 1023 |
| 38894 | 1023 |
| 38895 | 1023 |
| 38896 | 1023 |
| 38897 | 1023 |
| 38898 | 1023 |
| 38899 | 1023 |
| 38900 | 1023 |
| 38901 | 1023 |
| 38902 | 1023 |
| 38903 | 1023 |
| 38904 | 1023 |
| 38905 | 1023 |
| 38906 | 1023 |
| 38907 | 1023 |
| 38908 | 1023 |
| 38909 | 1023 |
| 38910 | 1023 |
| 38911 | 1023 |
| 38912 | 1023 |
| 38913 | 1023 |
| 38914 | 1023 |
| 38915 | 1023 |
| 38916 | 1023 |
| 38917 | 1023 |
| 38918 | 1023 |
| 38919 | 1023 |
| 38920 | 1023 |
| 38921 | 1023 |
| 38922 | 1023 |
| 38923 | 0 |
| 38924 | 0 |
| 38925 | 0 |
| 38926 | 0 |
| 38927 | 0 |
| 38928 | 0 |
| 38929 | 0 |
| 38930 | 0 |
| 38931 | 0 |
| 38932 | 0 |
| 38933 | 0 |
| 38934 | 0 |
| 38935 | 0 |
| 38936 | 0 |
| 38937 | 0 |
| 38938 | 1023 |
| 38939 | 1023 |
| 38940 | 1023 |
| 38941 | 1023 |
| 38942 | 1023 |
| 38943 | 1023 |
| 38944 | 1023 |
| 38945 | 1023 |
| 38946 | 1023 |
| 38947 | 1023 |
| 38948 | 1023 |
| 38949 | 1023 |
| 38950 | 1023 |
| 38951 | 1023 |
| 38952 | 1023 |
| 38953 | 1023 |
| 38954 | 1023 |
| 38955 | 1023 |
| 38956 | 1023 |
| 38957 | 1023 |
| 38958 | 1023 |
| 38959 | 1023 |
| 38960 | 1023 |
| 38961 | 1023 |
| 38962 | 1023 |
| 38963 | 1023 |
| 38964 | 1023 |
| 38965 | 1023 |
| 38966 | 1023 |
| 38967 | 1023 |
| 38968 | 1023 |
| 38969 | 1023 |
| 38970 | 1023 |
| 38971 | 1023 |
| 38972 | 1023 |
| 38973 | 1023 |
| 38974 | 1023 |
| 38975 | 1023 |
| 38976 | 0 |
| 38977 | 0 |
| 38978 | 0 |
| 38979 | 0 |
| 38980 | 0 |
| 38981 | 0 |
| 38982 | 0 |
| 38983 | 0 |
| 38984 | 0 |
| 38985 | 0 |
| 38986 | 0 |
| 38987 | 0 |
| 38988 | 0 |
| 38989 | 1023 |
| 38990 | 1023 |
| 38991 | 1023 |
| 38992 | 1023 |
| 38993 | 1023 |
| 38994 | 1023 |
| 38995 | 1023 |
| 38996 | 1023 |
| 38997 | 1023 |
| 38998 | 1023 |
| 38999 | 1023 |
| 39000 | 1023 |
| 39001 | 1023 |
| 39002 | 1023 |
| 39003 | 1023 |
| 39004 | 1023 |
| 39005 | 1023 |
| 39006 | 1023 |
| 39007 | 1023 |
| 39008 | 1023 |
| 39009 | 1023 |
| 39010 | 1023 |
| 39011 | 1023 |
| 39012 | 1023 |
| 39013 | 1023 |
| 39014 | 1023 |
| 39015 | 1023 |
| 39016 | 1023 |
| 39017 | 1023 |
| 39018 | 1023 |
| 39019 | 1023 |
| 39020 | 1023 |
| 39021 | 1023 |
| 39022 | 1023 |
| 39023 | 1023 |
| 39024 | 1023 |
| 39025 | 1023 |
| 39026 | 1023 |
| 39027 | 0 |
| 39028 | 0 |
| 39029 | 0 |
| 39030 | 0 |
| 39031 | 0 |
| 39032 | 0 |
| 39033 | 0 |
| 39034 | 0 |
| 39035 | 0 |
| 39036 | 0 |
| 39037 | 0 |
| 39038 | 0 |
| 39039 | 0 |
| 39040 | 1023 |
| 39041 | 1023 |
| 39042 | 1023 |
| 39043 | 1023 |
| 39044 | 1023 |
| 39045 | 1023 |
| 39046 | 1023 |
| 39047 | 1023 |
| 39048 | 1023 |
| 39049 | 1023 |
| 39050 | 1023 |
| 39051 | 1023 |
| 39052 | 1023 |
| 39053 | 1023 |
| 39054 | 1023 |
| 39055 | 1023 |
| 39056 | 1023 |
| 39057 | 1023 |
| 39058 | 1023 |
| 39059 | 1023 |
| 39060 | 1023 |
| 39061 | 1023 |
| 39062 | 1023 |
| 39063 | 1023 |
| 39064 | 1023 |
| 39065 | 1023 |
| 39066 | 1023 |
| 39067 | 1023 |
| 39068 | 1023 |
| 39069 | 1023 |
| 39070 | 1023 |
| 39071 | 1023 |
| 39072 | 1023 |
| 39073 | 1023 |
| 39074 | 1023 |
| 39075 | 1023 |
| 39076 | 1023 |
| 39077 | 1023 |
| 39078 | 0 |
| 39079 | 0 |
| 39080 | 0 |
| 39081 | 0 |
| 39082 | 0 |
| 39083 | 0 |
| 39084 | 0 |
| 39085 | 0 |
| 39086 | 0 |
| 39087 | 0 |
| 39088 | 0 |
| 39089 | 0 |
| 39090 | 0 |
| 39091 | 1023 |
| 39092 | 1023 |
| 39093 | 1023 |
| 39094 | 1023 |
| 39095 | 1023 |
| 39096 | 1023 |
| 39097 | 1023 |
| 39098 | 1023 |
| 39099 | 1023 |
| 39100 | 1023 |
| 39101 | 1023 |
| 39102 | 1023 |
| 39103 | 1023 |
| 39104 | 1023 |
| 39105 | 1023 |
| 39106 | 1023 |
| 39107 | 1023 |
| 39108 | 1023 |
| 39109 | 1023 |
| 39110 | 1023 |
| 39111 | 1023 |
| 39112 | 1023 |
| 39113 | 1023 |
| 39114 | 1023 |
| 39115 | 1023 |
| 39116 | 1023 |
| 39117 | 1023 |
| 39118 | 1023 |
| 39119 | 1023 |
| 39120 | 1023 |
| 39121 | 1023 |
| 39122 | 1023 |
| 39123 | 1023 |
| 39124 | 1023 |
| 39125 | 1023 |
| 39126 | 1023 |
| 39127 | 1023 |
| 39128 | 1023 |
| 39129 | 0 |
| 39130 | 0 |
| 39131 | 0 |
| 39132 | 0 |
| 39133 | 0 |
| 39134 | 0 |
| 39135 | 0 |
| 39136 | 0 |
| 39137 | 0 |
| 39138 | 0 |
| 39139 | 0 |
| 39140 | 0 |
| 39141 | 0 |
| 39142 | 1023 |
| 39143 | 1023 |
| 39144 | 1023 |
| 39145 | 1023 |
| 39146 | 1023 |
| 39147 | 1023 |
| 39148 | 1023 |
| 39149 | 1023 |
| 39150 | 1023 |
| 39151 | 1023 |
| 39152 | 1023 |
| 39153 | 1023 |
| 39154 | 1023 |
| 39155 | 1023 |
| 39156 | 1023 |
| 39157 | 1023 |
| 39158 | 1023 |
| 39159 | 1023 |
| 39160 | 1023 |
| 39161 | 1023 |
| 39162 | 1023 |
| 39163 | 1023 |
| 39164 | 1023 |
| 39165 | 1023 |
| 39166 | 1023 |
| 39167 | 1023 |
| 39168 | 1023 |
| 39169 | 1023 |
| 39170 | 1023 |
| 39171 | 1023 |
| 39172 | 1023 |
| 39173 | 1023 |
| 39174 | 1023 |
| 39175 | 1023 |
| 39176 | 1023 |
| 39177 | 1023 |
| 39178 | 1023 |
| 39179 | 1023 |
| 39180 | 0 |
| 39181 | 0 |
| 39182 | 0 |
| 39183 | 0 |
| 39184 | 0 |
| 39185 | 0 |
| 39186 | 0 |
| 39187 | 0 |
| 39188 | 0 |
| 39189 | 0 |
| 39190 | 0 |
| 39191 | 0 |
| 39192 | 0 |
| 39193 | 1023 |
| 39194 | 1023 |
| 39195 | 1023 |
| 39196 | 1023 |
| 39197 | 1023 |
| 39198 | 1023 |
| 39199 | 1023 |
| 39200 | 1023 |
| 39201 | 1023 |
| 39202 | 1023 |
| 39203 | 1023 |
| 39204 | 1023 |
| 39205 | 1023 |
| 39206 | 1023 |
| 39207 | 1023 |
| 39208 | 1023 |
| 39209 | 1023 |
| 39210 | 1023 |
| 39211 | 1023 |
| 39212 | 1023 |
| 39213 | 1023 |
| 39214 | 1023 |
| 39215 | 1023 |
| 39216 | 1023 |
| 39217 | 1023 |
| 39218 | 1023 |
| 39219 | 1023 |
| 39220 | 1023 |
| 39221 | 1023 |
| 39222 | 1023 |
| 39223 | 1023 |
| 39224 | 1023 |
| 39225 | 1023 |
| 39226 | 1023 |
| 39227 | 1023 |
| 39228 | 1023 |
| 39229 | 1023 |
| 39230 | 1023 |
| 39231 | 0 |
| 39232 | 0 |
| 39233 | 0 |
| 39234 | 0 |
| 39235 | 0 |
| 39236 | 0 |
| 39237 | 0 |
| 39238 | 0 |
| 39239 | 0 |
| 39240 | 0 |
| 39241 | 0 |
| 39242 | 0 |
| 39243 | 0 |
| 39244 | 1023 |
| 39245 | 1023 |
| 39246 | 1023 |
| 39247 | 1023 |
| 39248 | 1023 |
| 39249 | 1023 |
| 39250 | 1023 |
| 39251 | 1023 |
| 39252 | 1023 |
| 39253 | 1023 |
| 39254 | 1023 |
| 39255 | 1023 |
| 39256 | 1023 |
| 39257 | 1023 |
| 39258 | 1023 |
| 39259 | 1023 |
| 39260 | 1023 |
| 39261 | 1023 |
| 39262 | 1023 |
| 39263 | 1023 |
| 39264 | 1023 |
| 39265 | 1023 |
| 39266 | 1023 |
| 39267 | 1023 |
| 39268 | 1023 |
| 39269 | 1023 |
| 39270 | 1023 |
| 39271 | 1023 |
| 39272 | 1023 |
| 39273 | 1023 |
| 39274 | 1023 |
| 39275 | 1023 |
| 39276 | 1023 |
| 39277 | 1023 |
| 39278 | 1023 |
| 39279 | 1023 |
| 39280 | 1023 |
| 39281 | 1023 |
| 39282 | 0 |
| 39283 | 0 |
| 39284 | 0 |
| 39285 | 0 |
| 39286 | 1 |
| 39287 | 0 |
| 39288 | 0 |
| 39289 | 0 |
| 39290 | 0 |
| 39291 | 0 |
| 39292 | 0 |
| 39293 | 0 |
| 39294 | 0 |
| 39295 | 1023 |
| 39296 | 1023 |
| 39297 | 1023 |
| 39298 | 1023 |
| 39299 | 1023 |
| 39300 | 1023 |
| 39301 | 1023 |
| 39302 | 1023 |
| 39303 | 1023 |
| 39304 | 1023 |
| 39305 | 1023 |
| 39306 | 1023 |
| 39307 | 1023 |
| 39308 | 1023 |
| 39309 | 1023 |
| 39310 | 1023 |
| 39311 | 1023 |
| 39312 | 1023 |
| 39313 | 1023 |
| 39314 | 1023 |
| 39315 | 1023 |
| 39316 | 1023 |
| 39317 | 1023 |
| 39318 | 1023 |
| 39319 | 1023 |
| 39320 | 1023 |
| 39321 | 1023 |
| 39322 | 1023 |
| 39323 | 1023 |
| 39324 | 1023 |
| 39325 | 1023 |
| 39326 | 1023 |
| 39327 | 1023 |
| 39328 | 1023 |
| 39329 | 1023 |
| 39330 | 1023 |
| 39331 | 1023 |
| 39332 | 1023 |
| 39333 | 0 |
| 39334 | 0 |
| 39335 | 0 |
| 39336 | 0 |
| 39337 | 0 |
| 39338 | 0 |
| 39339 | 0 |
| 39340 | 0 |
| 39341 | 0 |
| 39342 | 0 |
| 39343 | 0 |
| 39344 | 0 |
| 39345 | 0 |
| 39346 | 0 |
| 39347 | 1023 |
| 39348 | 1023 |
| 39349 | 1023 |
| 39350 | 1023 |
| 39351 | 1023 |
| 39352 | 1023 |
| 39353 | 1023 |
| 39354 | 1023 |
| 39355 | 1023 |
| 39356 | 1023 |
| 39357 | 1023 |
| 39358 | 1023 |
| 39359 | 1023 |
| 39360 | 1023 |
| 39361 | 1023 |
| 39362 | 1023 |
| 39363 | 1023 |
| 39364 | 1023 |
| 39365 | 1023 |
| 39366 | 1023 |
| 39367 | 1023 |
| 39368 | 1023 |
| 39369 | 1023 |
| 39370 | 1023 |
| 39371 | 1023 |
| 39372 | 1023 |
| 39373 | 1023 |
| 39374 | 1023 |
| 39375 | 1023 |
| 39376 | 1023 |
| 39377 | 1023 |
| 39378 | 1023 |
| 39379 | 1023 |
| 39380 | 1023 |
| 39381 | 1023 |
| 39382 | 1023 |
| 39383 | 1023 |
| 39384 | 0 |
| 39385 | 0 |
| 39386 | 0 |
| 39387 | 0 |
| 39388 | 0 |
| 39389 | 0 |
| 39390 | 0 |
| 39391 | 0 |
| 39392 | 0 |
| 39393 | 0 |
| 39394 | 0 |
| 39395 | 0 |
| 39396 | 0 |
| 39397 | 0 |
| 39398 | 0 |
| 39399 | 1023 |
| 39400 | 1023 |
| 39401 | 1023 |
| 39402 | 1023 |
| 39403 | 1023 |
| 39404 | 1023 |
| 39405 | 1023 |
| 39406 | 1023 |
| 39407 | 1023 |
| 39408 | 1023 |
| 39409 | 1023 |
| 39410 | 1023 |
| 39411 | 1023 |
| 39412 | 1023 |
| 39413 | 1023 |
| 39414 | 1023 |
| 39415 | 1023 |
| 39416 | 1023 |
| 39417 | 1023 |
| 39418 | 1023 |
| 39419 | 1023 |
| 39420 | 1023 |
| 39421 | 1023 |
| 39422 | 1023 |
| 39423 | 1023 |
| 39424 | 1023 |
| 39425 | 1023 |
| 39426 | 1023 |
| 39427 | 1023 |
| 39428 | 1023 |
| 39429 | 1023 |
| 39430 | 1023 |
| 39431 | 1023 |
| 39432 | 1023 |
| 39433 | 1023 |
| 39434 | 1023 |
| 39435 | 1023 |
| 39436 | 0 |
| 39437 | 0 |
| 39438 | 0 |
| 39439 | 0 |
| 39440 | 0 |
| 39441 | 0 |
| 39442 | 0 |
| 39443 | 0 |
| 39444 | 0 |
| 39445 | 0 |
| 39446 | 0 |
| 39447 | 0 |
| 39448 | 0 |
| 39449 | 0 |
| 39450 | 0 |
| 39451 | 1023 |
| 39452 | 1023 |
| 39453 | 1023 |
| 39454 | 1023 |
| 39455 | 1023 |
| 39456 | 1023 |
| 39457 | 1023 |
| 39458 | 1023 |
| 39459 | 1023 |
| 39460 | 1023 |
| 39461 | 1023 |
| 39462 | 1023 |
| 39463 | 1023 |
| 39464 | 1023 |
| 39465 | 1023 |
| 39466 | 1023 |
| 39467 | 1023 |
| 39468 | 1023 |
| 39469 | 1023 |
| 39470 | 1023 |
| 39471 | 1023 |
| 39472 | 1023 |
| 39473 | 1023 |
| 39474 | 1023 |
| 39475 | 1023 |
| 39476 | 1023 |
| 39477 | 1023 |
| 39478 | 1023 |
| 39479 | 1023 |
| 39480 | 1023 |
| 39481 | 1023 |
| 39482 | 1023 |
| 39483 | 1023 |
| 39484 | 1023 |
| 39485 | 1023 |
| 39486 | 1023 |
| 39487 | 1023 |
| 39488 | 0 |
| 39489 | 0 |
| 39490 | 0 |
| 39491 | 0 |
| 39492 | 0 |
| 39493 | 0 |
| 39494 | 0 |
| 39495 | 0 |
| 39496 | 0 |
| 39497 | 0 |
| 39498 | 0 |
| 39499 | 0 |
| 39500 | 0 |
| 39501 | 0 |
| 39502 | 1023 |
| 39503 | 1023 |
| 39504 | 1023 |
| 39505 | 1023 |
| 39506 | 1023 |
| 39507 | 1023 |
| 39508 | 1023 |
| 39509 | 1023 |
| 39510 | 1023 |
| 39511 | 1023 |
| 39512 | 1023 |
| 39513 | 1023 |
| 39514 | 1023 |
| 39515 | 1023 |
| 39516 | 1023 |
| 39517 | 1023 |
| 39518 | 1023 |
| 39519 | 1023 |
| 39520 | 1023 |
| 39521 | 1023 |
| 39522 | 1023 |
| 39523 | 1023 |
| 39524 | 1023 |
| 39525 | 1023 |
| 39526 | 1023 |
| 39527 | 1023 |
| 39528 | 1023 |
| 39529 | 1023 |
| 39530 | 1023 |
| 39531 | 1023 |
| 39532 | 1023 |
| 39533 | 1023 |
| 39534 | 1023 |
| 39535 | 1023 |
| 39536 | 1023 |
| 39537 | 1023 |
| 39538 | 1023 |
| 39539 | 1023 |
| 39540 | 0 |
| 39541 | 0 |
| 39542 | 0 |
| 39543 | 0 |
| 39544 | 0 |
| 39545 | 0 |
| 39546 | 0 |
| 39547 | 0 |
| 39548 | 0 |
| 39549 | 0 |
| 39550 | 0 |
| 39551 | 0 |
| 39552 | 0 |
| 39553 | 0 |
| 39554 | 1023 |
| 39555 | 1023 |
| 39556 | 1023 |
| 39557 | 1023 |
| 39558 | 1023 |
| 39559 | 1023 |
| 39560 | 1023 |
| 39561 | 1023 |
| 39562 | 1023 |
| 39563 | 1023 |
| 39564 | 1023 |
| 39565 | 1023 |
| 39566 | 1023 |
| 39567 | 1023 |
| 39568 | 1023 |
| 39569 | 1023 |
| 39570 | 1023 |
| 39571 | 1023 |
| 39572 | 1023 |
| 39573 | 1023 |
| 39574 | 1023 |
| 39575 | 1023 |
| 39576 | 1023 |
| 39577 | 1023 |
| 39578 | 1023 |
| 39579 | 1023 |
| 39580 | 1023 |
| 39581 | 1023 |
| 39582 | 1023 |
| 39583 | 1023 |
| 39584 | 1023 |
| 39585 | 1023 |
| 39586 | 1023 |
| 39587 | 1023 |
| 39588 | 1023 |
| 39589 | 1023 |
| 39590 | 1023 |
| 39591 | 0 |
| 39592 | 0 |
| 39593 | 0 |
| 39594 | 0 |
| 39595 | 0 |
| 39596 | 0 |
| 39597 | 0 |
| 39598 | 0 |
| 39599 | 0 |
| 39600 | 0 |
| 39601 | 0 |
| 39602 | 0 |
| 39603 | 0 |
| 39604 | 0 |
| 39605 | 0 |
| 39606 | 1023 |
| 39607 | 1023 |
| 39608 | 1023 |
| 39609 | 1023 |
| 39610 | 1023 |
| 39611 | 1023 |
| 39612 | 1023 |
| 39613 | 1023 |
| 39614 | 1023 |
| 39615 | 1023 |
| 39616 | 1023 |
| 39617 | 1023 |
| 39618 | 1023 |
| 39619 | 1023 |
| 39620 | 1023 |
| 39621 | 1023 |
| 39622 | 1023 |
| 39623 | 1023 |
| 39624 | 1023 |
| 39625 | 1023 |
| 39626 | 1023 |
| 39627 | 1023 |
| 39628 | 1023 |
| 39629 | 1023 |
| 39630 | 1023 |
| 39631 | 1023 |
| 39632 | 1023 |
| 39633 | 1023 |
| 39634 | 1023 |
| 39635 | 1023 |
| 39636 | 1023 |
| 39637 | 1023 |
| 39638 | 1023 |
| 39639 | 1023 |
| 39640 | 1023 |
| 39641 | 1023 |
| 39642 | 1023 |
| 39643 | 1023 |
| 39644 | 0 |
| 39645 | 0 |
| 39646 | 0 |
| 39647 | 0 |
| 39648 | 0 |
| 39649 | 0 |
| 39650 | 0 |
| 39651 | 0 |
| 39652 | 0 |
| 39653 | 0 |
| 39654 | 0 |
| 39655 | 0 |
| 39656 | 0 |
| 39657 | 1023 |
| 39658 | 1023 |
| 39659 | 1023 |
| 39660 | 1023 |
| 39661 | 1023 |
| 39662 | 1023 |
| 39663 | 1023 |
| 39664 | 1023 |
| 39665 | 1023 |
| 39666 | 1023 |
| 39667 | 1023 |
| 39668 | 1023 |
| 39669 | 1023 |
| 39670 | 1023 |
| 39671 | 1023 |
| 39672 | 1023 |
| 39673 | 1023 |
| 39674 | 1023 |
| 39675 | 1023 |
| 39676 | 1023 |
| 39677 | 1023 |
| 39678 | 1023 |
| 39679 | 1023 |
| 39680 | 1023 |
| 39681 | 1023 |
| 39682 | 1023 |
| 39683 | 1023 |
| 39684 | 1023 |
| 39685 | 1023 |
| 39686 | 1023 |
| 39687 | 1023 |
| 39688 | 1023 |
| 39689 | 1023 |
| 39690 | 1023 |
| 39691 | 1023 |
| 39692 | 1023 |
| 39693 | 1023 |
| 39694 | 1023 |
| 39695 | 0 |
| 39696 | 0 |
| 39697 | 0 |
| 39698 | 0 |
| 39699 | 0 |
| 39700 | 0 |
| 39701 | 0 |
| 39702 | 0 |
| 39703 | 0 |
| 39704 | 0 |
| 39705 | 0 |
| 39706 | 0 |
| 39707 | 0 |
| 39708 | 1023 |
| 39709 | 1023 |
| 39710 | 1023 |
| 39711 | 1023 |
| 39712 | 1023 |
| 39713 | 1023 |
| 39714 | 1023 |
| 39715 | 1023 |
| 39716 | 1023 |
| 39717 | 1023 |
| 39718 | 1023 |
| 39719 | 1023 |
| 39720 | 1023 |
| 39721 | 1023 |
| 39722 | 1023 |
| 39723 | 1023 |
| 39724 | 1023 |
| 39725 | 1023 |
| 39726 | 1023 |
| 39727 | 1023 |
| 39728 | 1023 |
| 39729 | 1023 |
| 39730 | 1023 |
| 39731 | 1023 |
| 39732 | 1023 |
| 39733 | 1023 |
| 39734 | 1023 |
| 39735 | 1023 |
| 39736 | 1023 |
| 39737 | 1023 |
| 39738 | 1023 |
| 39739 | 1023 |
| 39740 | 1023 |
| 39741 | 1023 |
| 39742 | 1023 |
| 39743 | 1023 |
| 39744 | 1023 |
| 39745 | 1023 |
| 39746 | 0 |
| 39747 | 0 |
| 39748 | 0 |
| 39749 | 0 |
| 39750 | 0 |
| 39751 | 0 |
| 39752 | 0 |
| 39753 | 0 |
| 39754 | 0 |
| 39755 | 0 |
| 39756 | 0 |
| 39757 | 0 |
| 39758 | 0 |
| 39759 | 1023 |
| 39760 | 1023 |
| 39761 | 1023 |
| 39762 | 1023 |
| 39763 | 1023 |
| 39764 | 1023 |
| 39765 | 1023 |
| 39766 | 1023 |
| 39767 | 1023 |
| 39768 | 1023 |
| 39769 | 1023 |
| 39770 | 1023 |
| 39771 | 1023 |
| 39772 | 1023 |
| 39773 | 1023 |
| 39774 | 1023 |
| 39775 | 1023 |
| 39776 | 1023 |
| 39777 | 1023 |
| 39778 | 1023 |
| 39779 | 1023 |
| 39780 | 1023 |
| 39781 | 1023 |
| 39782 | 1023 |
| 39783 | 1023 |
| 39784 | 1023 |
| 39785 | 1023 |
| 39786 | 1023 |
| 39787 | 1023 |
| 39788 | 1023 |
| 39789 | 1023 |
| 39790 | 1023 |
| 39791 | 1023 |
| 39792 | 1023 |
| 39793 | 1023 |
| 39794 | 1023 |
| 39795 | 1023 |
| 39796 | 1023 |
| 39797 | 0 |
| 39798 | 0 |
| 39799 | 0 |
| 39800 | 0 |
| 39801 | 0 |
| 39802 | 0 |
| 39803 | 0 |
| 39804 | 0 |
| 39805 | 0 |
| 39806 | 0 |
| 39807 | 0 |
| 39808 | 0 |
| 39809 | 0 |
| 39810 | 1023 |
| 39811 | 1023 |
| 39812 | 1023 |
| 39813 | 1023 |
| 39814 | 1023 |
| 39815 | 1023 |
| 39816 | 1023 |
| 39817 | 1023 |
| 39818 | 1023 |
| 39819 | 1023 |
| 39820 | 1023 |
| 39821 | 1023 |
| 39822 | 1023 |
| 39823 | 1023 |
| 39824 | 1023 |
| 39825 | 1023 |
| 39826 | 1023 |
| 39827 | 1023 |
| 39828 | 1023 |
| 39829 | 1023 |
| 39830 | 1023 |
| 39831 | 1023 |
| 39832 | 1023 |
| 39833 | 1023 |
| 39834 | 1023 |
| 39835 | 1023 |
| 39836 | 1023 |
| 39837 | 1023 |
| 39838 | 1023 |
| 39839 | 1023 |
| 39840 | 1023 |
| 39841 | 1023 |
| 39842 | 1023 |
| 39843 | 1023 |
| 39844 | 1023 |
| 39845 | 1023 |
| 39846 | 1023 |
| 39847 | 1023 |
| 39848 | 0 |
| 39849 | 0 |
| 39850 | 0 |
| 39851 | 0 |
| 39852 | 0 |
| 39853 | 0 |
| 39854 | 0 |
| 39855 | 0 |
| 39856 | 1 |
| 39857 | 0 |
| 39858 | 0 |
| 39859 | 0 |
| 39860 | 0 |
| 39861 | 1023 |
| 39862 | 1023 |
| 39863 | 1023 |
| 39864 | 1023 |
| 39865 | 1023 |
| 39866 | 1023 |
| 39867 | 1023 |
| 39868 | 1023 |
| 39869 | 1023 |
| 39870 | 1023 |
| 39871 | 1023 |
| 39872 | 1023 |
| 39873 | 1023 |
| 39874 | 1023 |
| 39875 | 1023 |
| 39876 | 1023 |
| 39877 | 1023 |
| 39878 | 1023 |
| 39879 | 1023 |
| 39880 | 1023 |
| 39881 | 1023 |
| 39882 | 1023 |
| 39883 | 1023 |
| 39884 | 1023 |
| 39885 | 1023 |
| 39886 | 1023 |
| 39887 | 1023 |
| 39888 | 1023 |
| 39889 | 1023 |
| 39890 | 1023 |
| 39891 | 1023 |
| 39892 | 1023 |
| 39893 | 1023 |
| 39894 | 1023 |
| 39895 | 1023 |
| 39896 | 1023 |
| 39897 | 1023 |
| 39898 | 1023 |
| 39899 | 0 |
| 39900 | 0 |
| 39901 | 0 |
| 39902 | 0 |
| 39903 | 0 |
| 39904 | 0 |
| 39905 | 0 |
| 39906 | 0 |
| 39907 | 0 |
| 39908 | 0 |
| 39909 | 0 |
| 39910 | 0 |
| 39911 | 0 |
| 39912 | 1023 |
| 39913 | 1023 |
| 39914 | 1023 |
| 39915 | 1023 |
| 39916 | 1023 |
| 39917 | 1023 |
| 39918 | 1023 |
| 39919 | 1023 |
| 39920 | 1023 |
| 39921 | 1023 |
| 39922 | 1023 |
| 39923 | 1023 |
| 39924 | 1023 |
| 39925 | 1023 |
| 39926 | 1023 |
| 39927 | 1023 |
| 39928 | 1023 |
| 39929 | 1023 |
| 39930 | 1023 |
| 39931 | 1023 |
| 39932 | 1023 |
| 39933 | 1023 |
| 39934 | 1023 |
| 39935 | 1023 |
| 39936 | 1023 |
| 39937 | 1023 |
| 39938 | 1023 |
| 39939 | 1023 |
| 39940 | 1023 |
| 39941 | 1023 |
| 39942 | 1023 |
| 39943 | 1023 |
| 39944 | 1023 |
| 39945 | 1023 |
| 39946 | 1023 |
| 39947 | 1023 |
| 39948 | 1023 |
| 39949 | 1023 |
| 39950 | 0 |
| 39951 | 0 |
| 39952 | 0 |
| 39953 | 0 |
| 39954 | 0 |
| 39955 | 0 |
| 39956 | 0 |
| 39957 | 0 |
| 39958 | 0 |
| 39959 | 0 |
| 39960 | 0 |
| 39961 | 0 |
| 39962 | 0 |
| 39963 | 0 |
| 39964 | 1023 |
| 39965 | 1023 |
| 39966 | 1023 |
| 39967 | 1023 |
| 39968 | 1023 |
| 39969 | 1023 |
| 39970 | 1023 |
| 39971 | 1023 |
| 39972 | 1023 |
| 39973 | 1023 |
| 39974 | 1023 |
| 39975 | 1023 |
| 39976 | 1023 |
| 39977 | 1023 |
| 39978 | 1023 |
| 39979 | 1023 |
| 39980 | 1023 |
| 39981 | 1023 |
| 39982 | 1023 |
| 39983 | 1023 |
| 39984 | 1023 |
| 39985 | 1023 |
| 39986 | 1023 |
| 39987 | 1023 |
| 39988 | 1023 |
| 39989 | 1023 |
| 39990 | 1023 |
| 39991 | 1023 |
| 39992 | 1023 |
| 39993 | 1023 |
| 39994 | 1023 |
| 39995 | 1023 |
| 39996 | 1023 |
| 39997 | 1023 |
| 39998 | 1023 |
| 39999 | 1023 |
| 40000 | 1023 |
| 40001 | 0 |
| 40002 | 0 |
| 40003 | 0 |
| 40004 | 0 |
| 40005 | 0 |
| 40006 | 0 |
| 40007 | 0 |
| 40008 | 0 |
| 40009 | 0 |
| 40010 | 0 |
| 40011 | 0 |
| 40012 | 0 |
| 40013 | 0 |
| 40014 | 0 |
| 40015 | 1023 |
| 40016 | 1023 |
| 40017 | 1023 |
| 40018 | 1023 |
| 40019 | 1023 |
| 40020 | 1023 |
| 40021 | 1023 |
| 40022 | 1023 |
| 40023 | 1023 |
| 40024 | 1023 |
| 40025 | 1023 |
| 40026 | 1023 |
| 40027 | 1023 |
| 40028 | 1023 |
| 40029 | 1023 |
| 40030 | 1023 |
| 40031 | 1023 |
| 40032 | 1023 |
| 40033 | 1023 |
| 40034 | 1023 |
| 40035 | 1023 |
| 40036 | 1023 |
| 40037 | 1023 |
| 40038 | 1023 |
| 40039 | 1023 |
| 40040 | 1023 |
| 40041 | 1023 |
| 40042 | 1023 |
| 40043 | 1023 |
| 40044 | 1023 |
| 40045 | 1023 |
| 40046 | 1023 |
| 40047 | 1023 |
| 40048 | 1023 |
| 40049 | 1023 |
| 40050 | 1023 |
| 40051 | 1023 |
| 40052 | 1023 |
| 40053 | 0 |
| 40054 | 0 |
| 40055 | 0 |
| 40056 | 0 |
| 40057 | 0 |
| 40058 | 0 |
| 40059 | 0 |
| 40060 | 0 |
| 40061 | 0 |
| 40062 | 0 |
| 40063 | 0 |
| 40064 | 0 |
| 40065 | 0 |
| 40066 | 0 |
| 40067 | 1023 |
| 40068 | 1023 |
| 40069 | 1023 |
| 40070 | 1023 |
| 40071 | 1023 |
| 40072 | 1023 |
| 40073 | 1023 |
| 40074 | 1023 |
| 40075 | 1023 |
| 40076 | 1023 |
| 40077 | 1023 |
| 40078 | 1023 |
| 40079 | 1023 |
| 40080 | 1023 |
| 40081 | 1023 |
| 40082 | 1023 |
| 40083 | 1023 |
| 40084 | 1023 |
| 40085 | 1023 |
| 40086 | 1023 |
| 40087 | 1023 |
| 40088 | 1023 |
| 40089 | 1023 |
| 40090 | 1023 |
| 40091 | 1023 |
| 40092 | 1023 |
| 40093 | 1023 |
| 40094 | 1023 |
| 40095 | 1023 |
| 40096 | 1023 |
| 40097 | 1023 |
| 40098 | 1023 |
| 40099 | 1023 |
| 40100 | 1023 |
| 40101 | 1023 |
| 40102 | 1023 |
| 40103 | 1023 |
| 40104 | 0 |
| 40105 | 0 |
| 40106 | 0 |
| 40107 | 0 |
| 40108 | 0 |
| 40109 | 0 |
| 40110 | 0 |
| 40111 | 0 |
| 40112 | 0 |
| 40113 | 0 |
| 40114 | 0 |
| 40115 | 0 |
| 40116 | 0 |
| 40117 | 0 |
| 40118 | 0 |
| 40119 | 1023 |
| 40120 | 1023 |
| 40121 | 1023 |
| 40122 | 1023 |
| 40123 | 1023 |
| 40124 | 1023 |
| 40125 | 1023 |
| 40126 | 1023 |
| 40127 | 1023 |
| 40128 | 1023 |
| 40129 | 1023 |
| 40130 | 1023 |
| 40131 | 1023 |
| 40132 | 1023 |
| 40133 | 1023 |
| 40134 | 1023 |
| 40135 | 1023 |
| 40136 | 1023 |
| 40137 | 1023 |
| 40138 | 1023 |
| 40139 | 1023 |
| 40140 | 1023 |
| 40141 | 1023 |
| 40142 | 1023 |
| 40143 | 1023 |
| 40144 | 1023 |
| 40145 | 1023 |
| 40146 | 1023 |
| 40147 | 1023 |
| 40148 | 1023 |
| 40149 | 1023 |
| 40150 | 1023 |
| 40151 | 1023 |
| 40152 | 1023 |
| 40153 | 1023 |
| 40154 | 1023 |
| 40155 | 1023 |
| 40156 | 0 |
| 40157 | 0 |
| 40158 | 0 |
| 40159 | 0 |
| 40160 | 0 |
| 40161 | 0 |
| 40162 | 0 |
| 40163 | 0 |
| 40164 | 0 |
| 40165 | 0 |
| 40166 | 0 |
| 40167 | 0 |
| 40168 | 0 |
| 40169 | 0 |
| 40170 | 0 |
| 40171 | 1023 |
| 40172 | 1023 |
| 40173 | 1023 |
| 40174 | 1023 |
| 40175 | 1023 |
| 40176 | 1023 |
| 40177 | 1023 |
| 40178 | 1023 |
| 40179 | 1023 |
| 40180 | 1023 |
| 40181 | 1023 |
| 40182 | 1023 |
| 40183 | 1023 |
| 40184 | 1023 |
| 40185 | 1023 |
| 40186 | 1023 |
| 40187 | 1023 |
| 40188 | 1023 |
| 40189 | 1023 |
| 40190 | 1023 |
| 40191 | 1023 |
| 40192 | 1023 |
| 40193 | 1023 |
| 40194 | 1023 |
| 40195 | 1023 |
| 40196 | 1023 |
| 40197 | 1023 |
| 40198 | 1023 |
| 40199 | 1023 |
| 40200 | 1023 |
| 40201 | 1023 |
| 40202 | 1023 |
| 40203 | 1023 |
| 40204 | 1023 |
| 40205 | 1023 |
| 40206 | 1023 |
| 40207 | 1023 |
| 40208 | 1023 |
| 40209 | 0 |
| 40210 | 0 |
| 40211 | 0 |
| 40212 | 0 |
| 40213 | 0 |
| 40214 | 0 |
| 40215 | 0 |
| 40216 | 0 |
| 40217 | 0 |
| 40218 | 0 |
| 40219 | 0 |
| 40220 | 0 |
| 40221 | 0 |
| 40222 | 1023 |
| 40223 | 1023 |
| 40224 | 1023 |
| 40225 | 1023 |
| 40226 | 1023 |
| 40227 | 1023 |
| 40228 | 1023 |
| 40229 | 1023 |
| 40230 | 1023 |
| 40231 | 1023 |
| 40232 | 1023 |
| 40233 | 1023 |
| 40234 | 1023 |
| 40235 | 1023 |
| 40236 | 1023 |
| 40237 | 1023 |
| 40238 | 1023 |
| 40239 | 1023 |
| 40240 | 1023 |
| 40241 | 1023 |
| 40242 | 1023 |
| 40243 | 1023 |
| 40244 | 1023 |
| 40245 | 1023 |
| 40246 | 1023 |
| 40247 | 1023 |
| 40248 | 1023 |
| 40249 | 1023 |
| 40250 | 1023 |
| 40251 | 1023 |
| 40252 | 1023 |
| 40253 | 1023 |
| 40254 | 1023 |
| 40255 | 1023 |
| 40256 | 1023 |
| 40257 | 1023 |
| 40258 | 1023 |
| 40259 | 1023 |
| 40260 | 0 |
| 40261 | 0 |
| 40262 | 0 |
| 40263 | 0 |
| 40264 | 0 |
| 40265 | 0 |
| 40266 | 0 |
| 40267 | 0 |
| 40268 | 0 |
| 40269 | 0 |
| 40270 | 0 |
| 40271 | 0 |
| 40272 | 0 |
| 40273 | 1023 |
| 40274 | 1023 |
| 40275 | 1023 |
| 40276 | 1023 |
| 40277 | 1023 |
| 40278 | 1023 |
| 40279 | 1023 |
| 40280 | 1023 |
| 40281 | 1023 |
| 40282 | 1023 |
| 40283 | 1023 |
| 40284 | 1023 |
| 40285 | 1023 |
| 40286 | 1023 |
| 40287 | 1023 |
| 40288 | 1023 |
| 40289 | 1023 |
| 40290 | 1023 |
| 40291 | 1023 |
| 40292 | 1023 |
| 40293 | 1023 |
| 40294 | 1023 |
| 40295 | 1023 |
| 40296 | 1023 |
| 40297 | 1023 |
| 40298 | 1023 |
| 40299 | 1023 |
| 40300 | 1023 |
| 40301 | 1023 |
| 40302 | 1023 |
| 40303 | 1023 |
| 40304 | 1023 |
| 40305 | 1023 |
| 40306 | 1023 |
| 40307 | 1023 |
| 40308 | 1023 |
| 40309 | 1023 |
| 40310 | 1023 |
| 40311 | 0 |
| 40312 | 0 |
| 40313 | 0 |
| 40314 | 0 |
| 40315 | 0 |
| 40316 | 0 |
| 40317 | 0 |
| 40318 | 0 |
| 40319 | 0 |
| 40320 | 0 |
| 40321 | 0 |
| 40322 | 0 |
| 40323 | 0 |
| 40324 | 1023 |
| 40325 | 1023 |
| 40326 | 1023 |
| 40327 | 1023 |
| 40328 | 1023 |
| 40329 | 1023 |
| 40330 | 1023 |
| 40331 | 1023 |
| 40332 | 1023 |
| 40333 | 1023 |
| 40334 | 1023 |
| 40335 | 1023 |
| 40336 | 1023 |
| 40337 | 1023 |
| 40338 | 1023 |
| 40339 | 1023 |
| 40340 | 1023 |
| 40341 | 1023 |
| 40342 | 1023 |
| 40343 | 1023 |
| 40344 | 1023 |
| 40345 | 1023 |
| 40346 | 1023 |
| 40347 | 1023 |
| 40348 | 1023 |
| 40349 | 1023 |
| 40350 | 1023 |
| 40351 | 1023 |
| 40352 | 1023 |
| 40353 | 1023 |
| 40354 | 1023 |
| 40355 | 1023 |
| 40356 | 1023 |
| 40357 | 1023 |
| 40358 | 1023 |
| 40359 | 1023 |
| 40360 | 1023 |
| 40361 | 1023 |
| 40362 | 0 |
| 40363 | 0 |
| 40364 | 0 |
| 40365 | 0 |
| 40366 | 0 |
| 40367 | 0 |
| 40368 | 0 |
| 40369 | 0 |
| 40370 | 0 |
| 40371 | 0 |
| 40372 | 0 |
| 40373 | 0 |
| 40374 | 0 |
| 40375 | 1023 |
| 40376 | 1023 |
| 40377 | 1023 |
| 40378 | 1023 |
| 40379 | 1023 |
| 40380 | 1023 |
| 40381 | 1023 |
| 40382 | 1023 |
| 40383 | 1023 |
| 40384 | 1023 |
| 40385 | 1023 |
| 40386 | 1023 |
| 40387 | 1023 |
| 40388 | 1023 |
| 40389 | 1023 |
| 40390 | 1023 |
| 40391 | 1023 |
| 40392 | 1023 |
| 40393 | 1023 |
| 40394 | 1023 |
| 40395 | 1023 |
| 40396 | 1023 |
| 40397 | 1023 |
| 40398 | 1023 |
| 40399 | 1023 |
| 40400 | 1023 |
| 40401 | 1023 |
| 40402 | 1023 |
| 40403 | 1023 |
| 40404 | 1023 |
| 40405 | 1023 |
| 40406 | 1023 |
| 40407 | 1023 |
| 40408 | 1023 |
| 40409 | 1023 |
| 40410 | 1023 |
| 40411 | 1023 |
| 40412 | 1023 |
| 40413 | 0 |
| 40414 | 0 |
| 40415 | 0 |
| 40416 | 0 |
| 40417 | 0 |
| 40418 | 0 |
| 40419 | 0 |
| 40420 | 0 |
| 40421 | 0 |
| 40422 | 0 |
| 40423 | 0 |
| 40424 | 0 |
| 40425 | 0 |
| 40426 | 1023 |
| 40427 | 1023 |
| 40428 | 1023 |
| 40429 | 1023 |
| 40430 | 1023 |
| 40431 | 1023 |
| 40432 | 1023 |
| 40433 | 1023 |
| 40434 | 1023 |
| 40435 | 1023 |
| 40436 | 1023 |
| 40437 | 1023 |
| 40438 | 1023 |
| 40439 | 1023 |
| 40440 | 1023 |
| 40441 | 1023 |
| 40442 | 1023 |
| 40443 | 1023 |
| 40444 | 1023 |
| 40445 | 1023 |
| 40446 | 1023 |
| 40447 | 1023 |
| 40448 | 1023 |
| 40449 | 1023 |
| 40450 | 1023 |
| 40451 | 1023 |
| 40452 | 1023 |
| 40453 | 1023 |
| 40454 | 1023 |
| 40455 | 1023 |
| 40456 | 1023 |
| 40457 | 1023 |
| 40458 | 1023 |
| 40459 | 1023 |
| 40460 | 1023 |
| 40461 | 1023 |
| 40462 | 1023 |
| 40463 | 1023 |
| 40464 | 0 |
| 40465 | 0 |
| 40466 | 0 |
| 40467 | 0 |
| 40468 | 0 |
| 40469 | 0 |
| 40470 | 0 |
| 40471 | 0 |
| 40472 | 0 |
| 40473 | 0 |
| 40474 | 0 |
| 40475 | 0 |
| 40476 | 0 |
| 40477 | 1023 |
| 40478 | 1023 |
| 40479 | 1023 |
| 40480 | 1023 |
| 40481 | 1023 |
| 40482 | 1023 |
| 40483 | 1023 |
| 40484 | 1023 |
| 40485 | 1023 |
| 40486 | 1023 |
| 40487 | 1023 |
| 40488 | 1023 |
| 40489 | 1023 |
| 40490 | 1023 |
| 40491 | 1023 |
| 40492 | 1023 |
| 40493 | 1023 |
| 40494 | 1023 |
| 40495 | 1023 |
| 40496 | 1023 |
| 40497 | 1023 |
| 40498 | 1023 |
| 40499 | 1023 |
| 40500 | 1023 |
| 40501 | 1023 |
| 40502 | 1023 |
| 40503 | 1023 |
| 40504 | 1023 |
| 40505 | 1023 |
| 40506 | 1023 |
| 40507 | 1023 |
| 40508 | 1023 |
| 40509 | 1023 |
| 40510 | 1023 |
| 40511 | 1023 |
| 40512 | 1023 |
| 40513 | 1023 |
| 40514 | 1023 |
| 40515 | 0 |
| 40516 | 0 |
| 40517 | 0 |
| 40518 | 0 |
| 40519 | 0 |
| 40520 | 1 |
| 40521 | 1 |
| 40522 | 0 |
| 40523 | 0 |
| 40524 | 0 |
| 40525 | 0 |
| 40526 | 0 |
| 40527 | 0 |
| 40528 | 1023 |
| 40529 | 1023 |
| 40530 | 1023 |
| 40531 | 1023 |
| 40532 | 1023 |
| 40533 | 1023 |
| 40534 | 1023 |
| 40535 | 1023 |
| 40536 | 1023 |
| 40537 | 1023 |
| 40538 | 1023 |
| 40539 | 1023 |
| 40540 | 1023 |
| 40541 | 1023 |
| 40542 | 1023 |
| 40543 | 1023 |
| 40544 | 1023 |
| 40545 | 1023 |
| 40546 | 1023 |
| 40547 | 1023 |
| 40548 | 1023 |
| 40549 | 1023 |
| 40550 | 1023 |
| 40551 | 1023 |
| 40552 | 1023 |
| 40553 | 1023 |
| 40554 | 1023 |
| 40555 | 1023 |
| 40556 | 1023 |
| 40557 | 1023 |
| 40558 | 1023 |
| 40559 | 1023 |
| 40560 | 1023 |
| 40561 | 1023 |
| 40562 | 1023 |
| 40563 | 1023 |
| 40564 | 1023 |
| 40565 | 1023 |
| 40566 | 0 |
| 40567 | 0 |
| 40568 | 0 |
| 40569 | 0 |
| 40570 | 0 |
| 40571 | 0 |
| 40572 | 0 |
| 40573 | 0 |
| 40574 | 0 |
| 40575 | 0 |
| 40576 | 0 |
| 40577 | 0 |
| 40578 | 0 |
| 40579 | 0 |
| 40580 | 1023 |
| 40581 | 1023 |
| 40582 | 1023 |
| 40583 | 1023 |
| 40584 | 1023 |
| 40585 | 1023 |
| 40586 | 1023 |
| 40587 | 1023 |
| 40588 | 1023 |
| 40589 | 1023 |
| 40590 | 1023 |
| 40591 | 1023 |
| 40592 | 1023 |
| 40593 | 1023 |
| 40594 | 1023 |
| 40595 | 1023 |
| 40596 | 1023 |
| 40597 | 1023 |
| 40598 | 1023 |
| 40599 | 1023 |
| 40600 | 1023 |
| 40601 | 1023 |
| 40602 | 1023 |
| 40603 | 1023 |
| 40604 | 1023 |
| 40605 | 1023 |
| 40606 | 1023 |
| 40607 | 1023 |
| 40608 | 1023 |
| 40609 | 1023 |
| 40610 | 1023 |
| 40611 | 1023 |
| 40612 | 1023 |
| 40613 | 1023 |
| 40614 | 1023 |
| 40615 | 1023 |
| 40616 | 1023 |
| 40617 | 0 |
| 40618 | 0 |
| 40619 | 0 |
| 40620 | 0 |
| 40621 | 0 |
| 40622 | 0 |
| 40623 | 0 |
| 40624 | 0 |
| 40625 | 0 |
| 40626 | 0 |
| 40627 | 0 |
| 40628 | 0 |
| 40629 | 0 |
| 40630 | 0 |
| 40631 | 0 |
| 40632 | 1023 |
| 40633 | 1023 |
| 40634 | 1023 |
| 40635 | 1023 |
| 40636 | 1023 |
| 40637 | 1023 |
| 40638 | 1023 |
| 40639 | 1023 |
| 40640 | 1023 |
| 40641 | 1023 |
| 40642 | 1023 |
| 40643 | 1023 |
| 40644 | 1023 |
| 40645 | 1023 |
| 40646 | 1023 |
| 40647 | 1023 |
| 40648 | 1023 |
| 40649 | 1023 |
| 40650 | 1023 |
| 40651 | 1023 |
| 40652 | 1023 |
| 40653 | 1023 |
| 40654 | 1023 |
| 40655 | 1023 |
| 40656 | 1023 |
| 40657 | 1023 |
| 40658 | 1023 |
| 40659 | 1023 |
| 40660 | 1023 |
| 40661 | 1023 |
| 40662 | 1023 |
| 40663 | 1023 |
| 40664 | 1023 |
| 40665 | 1023 |
| 40666 | 1023 |
| 40667 | 1023 |
| 40668 | 1023 |
| 40669 | 0 |
| 40670 | 0 |
| 40671 | 0 |
| 40672 | 0 |
| 40673 | 0 |
| 40674 | 0 |
| 40675 | 0 |
| 40676 | 0 |
| 40677 | 0 |
| 40678 | 0 |
| 40679 | 0 |
| 40680 | 0 |
| 40681 | 0 |
| 40682 | 0 |
| 40683 | 0 |
| 40684 | 1023 |
| 40685 | 1023 |
| 40686 | 1023 |
| 40687 | 1023 |
| 40688 | 1023 |
| 40689 | 1023 |
| 40690 | 1023 |
| 40691 | 1023 |
| 40692 | 1023 |
| 40693 | 1023 |
| 40694 | 1023 |
| 40695 | 1023 |
| 40696 | 1023 |
| 40697 | 1023 |
| 40698 | 1023 |
| 40699 | 1023 |
| 40700 | 1023 |
| 40701 | 1023 |
| 40702 | 1023 |
| 40703 | 1023 |
| 40704 | 1023 |
| 40705 | 1023 |
| 40706 | 1023 |
| 40707 | 1023 |
| 40708 | 1023 |
| 40709 | 1023 |
| 40710 | 1023 |
| 40711 | 1023 |
| 40712 | 1023 |
| 40713 | 1023 |
| 40714 | 1023 |
| 40715 | 1023 |
| 40716 | 1023 |
| 40717 | 1023 |
| 40718 | 1023 |
| 40719 | 1023 |
| 40720 | 1023 |
| 40721 | 1 |
| 40722 | 0 |
| 40723 | 0 |
| 40724 | 0 |
| 40725 | 0 |
| 40726 | 0 |
| 40727 | 0 |
| 40728 | 0 |
| 40729 | 0 |
| 40730 | 0 |
| 40731 | 0 |
| 40732 | 0 |
| 40733 | 0 |
| 40734 | 0 |
| 40735 | 1023 |
| 40736 | 1023 |
| 40737 | 1023 |
| 40738 | 1023 |
| 40739 | 1023 |
| 40740 | 1023 |
| 40741 | 1023 |
| 40742 | 1023 |
| 40743 | 1023 |
| 40744 | 1023 |
| 40745 | 1023 |
| 40746 | 1023 |
| 40747 | 1023 |
| 40748 | 1023 |
| 40749 | 1023 |
| 40750 | 1023 |
| 40751 | 1023 |
| 40752 | 1023 |
| 40753 | 1023 |
| 40754 | 1023 |
| 40755 | 1023 |
| 40756 | 1023 |
| 40757 | 1023 |
| 40758 | 1023 |
| 40759 | 1023 |
| 40760 | 1023 |
| 40761 | 1023 |
| 40762 | 1023 |
| 40763 | 1023 |
| 40764 | 1023 |
| 40765 | 1023 |
| 40766 | 1023 |
| 40767 | 1023 |
| 40768 | 1023 |
| 40769 | 1023 |
| 40770 | 1023 |
| 40771 | 1023 |
| 40772 | 1023 |
| 40773 | 0 |
| 40774 | 0 |
| 40775 | 0 |
| 40776 | 0 |
| 40777 | 0 |
| 40778 | 0 |
| 40779 | 0 |
| 40780 | 0 |
| 40781 | 0 |
| 40782 | 0 |
| 40783 | 0 |
| 40784 | 0 |
| 40785 | 0 |
| 40786 | 0 |
| 40787 | 1023 |
| 40788 | 1023 |
| 40789 | 1023 |
| 40790 | 1023 |
| 40791 | 1023 |
| 40792 | 1023 |
| 40793 | 1023 |
| 40794 | 1023 |
| 40795 | 1023 |
| 40796 | 1023 |
| 40797 | 1023 |
| 40798 | 1023 |
| 40799 | 1023 |
| 40800 | 1023 |
| 40801 | 1023 |
| 40802 | 1023 |
| 40803 | 1023 |
| 40804 | 1023 |
| 40805 | 1023 |
| 40806 | 1023 |
| 40807 | 1023 |
| 40808 | 1023 |
| 40809 | 1023 |
| 40810 | 1023 |
| 40811 | 1023 |
| 40812 | 1023 |
| 40813 | 1023 |
| 40814 | 1023 |
| 40815 | 1023 |
| 40816 | 1023 |
| 40817 | 1023 |
| 40818 | 1023 |
| 40819 | 1023 |
| 40820 | 1023 |
| 40821 | 1023 |
| 40822 | 1023 |
| 40823 | 1023 |
| 40824 | 1023 |
| 40825 | 0 |
| 40826 | 0 |
| 40827 | 0 |
| 40828 | 0 |
| 40829 | 0 |
| 40830 | 0 |
| 40831 | 0 |
| 40832 | 0 |
| 40833 | 1 |
| 40834 | 0 |
| 40835 | 0 |
| 40836 | 0 |
| 40837 | 0 |
| 40838 | 1023 |
| 40839 | 1023 |
| 40840 | 1023 |
| 40841 | 1023 |
| 40842 | 1023 |
| 40843 | 1023 |
| 40844 | 1023 |
| 40845 | 1023 |
| 40846 | 1023 |
| 40847 | 1023 |
| 40848 | 1023 |
| 40849 | 1023 |
| 40850 | 1023 |
| 40851 | 1023 |
| 40852 | 1023 |
| 40853 | 1023 |
| 40854 | 1023 |
| 40855 | 1023 |
| 40856 | 1023 |
| 40857 | 1023 |
| 40858 | 1023 |
| 40859 | 1023 |
| 40860 | 1023 |
| 40861 | 1023 |
| 40862 | 1023 |
| 40863 | 1023 |
| 40864 | 1023 |
| 40865 | 1023 |
| 40866 | 1023 |
| 40867 | 1023 |
| 40868 | 1023 |
| 40869 | 1023 |
| 40870 | 1023 |
| 40871 | 1023 |
| 40872 | 1023 |
| 40873 | 1023 |
| 40874 | 1023 |
| 40875 | 1023 |
| 40876 | 0 |
| 40877 | 0 |
| 40878 | 0 |
| 40879 | 0 |
| 40880 | 0 |
| 40881 | 0 |
| 40882 | 0 |
| 40883 | 0 |
| 40884 | 0 |
| 40885 | 0 |
| 40886 | 0 |
| 40887 | 0 |
| 40888 | 0 |
| 40889 | 1023 |
| 40890 | 1023 |
| 40891 | 1023 |
| 40892 | 1023 |
| 40893 | 1023 |
| 40894 | 1023 |
| 40895 | 1023 |
| 40896 | 1023 |
| 40897 | 1023 |
| 40898 | 1023 |
| 40899 | 1023 |
| 40900 | 1023 |
| 40901 | 1023 |
| 40902 | 1023 |
| 40903 | 1023 |
| 40904 | 1023 |
| 40905 | 1023 |
| 40906 | 1023 |
| 40907 | 1023 |
| 40908 | 1023 |
| 40909 | 1023 |
| 40910 | 1023 |
| 40911 | 1023 |
| 40912 | 1023 |
| 40913 | 1023 |
| 40914 | 1023 |
| 40915 | 1023 |
| 40916 | 1023 |
| 40917 | 1023 |
| 40918 | 1023 |
| 40919 | 1023 |
| 40920 | 1023 |
| 40921 | 1023 |
| 40922 | 1023 |
| 40923 | 1023 |
| 40924 | 1023 |
| 40925 | 1023 |
| 40926 | 1023 |
| 40927 | 0 |
| 40928 | 0 |
| 40929 | 0 |
| 40930 | 0 |
| 40931 | 0 |
| 40932 | 0 |
| 40933 | 0 |
| 40934 | 0 |
| 40935 | 0 |
| 40936 | 0 |
| 40937 | 0 |
| 40938 | 0 |
| 40939 | 0 |
| 40940 | 1023 |
| 40941 | 1023 |
| 40942 | 1023 |
| 40943 | 1023 |
| 40944 | 1023 |
| 40945 | 1023 |
| 40946 | 1023 |
| 40947 | 1023 |
| 40948 | 1023 |
| 40949 | 1023 |
| 40950 | 1023 |
| 40951 | 1023 |
| 40952 | 1023 |
| 40953 | 1023 |
| 40954 | 1023 |
| 40955 | 1023 |
| 40956 | 1023 |
| 40957 | 1023 |
| 40958 | 1023 |
| 40959 | 1023 |
| 40960 | 1023 |
| 40961 | 1023 |
| 40962 | 1023 |
| 40963 | 1023 |
| 40964 | 1023 |
| 40965 | 1023 |
| 40966 | 1023 |
| 40967 | 1023 |
| 40968 | 1023 |
| 40969 | 1023 |
| 40970 | 1023 |
| 40971 | 1023 |
| 40972 | 1023 |
| 40973 | 1023 |
| 40974 | 1023 |
| 40975 | 1023 |
| 40976 | 1023 |
| 40977 | 1023 |
| 40978 | 0 |
| 40979 | 0 |
| 40980 | 0 |
| 40981 | 0 |
| 40982 | 0 |
| 40983 | 0 |
| 40984 | 0 |
| 40985 | 0 |
| 40986 | 0 |
| 40987 | 0 |
| 40988 | 0 |
| 40989 | 0 |
| 40990 | 0 |
| 40991 | 1023 |
| 40992 | 1023 |
| 40993 | 1023 |
| 40994 | 1023 |
| 40995 | 1023 |
| 40996 | 1023 |
| 40997 | 1023 |
| 40998 | 1023 |
| 40999 | 1023 |
| 41000 | 1023 |
| 41001 | 1023 |
| 41002 | 1023 |
| 41003 | 1023 |
| 41004 | 1023 |
| 41005 | 1023 |
| 41006 | 1023 |
| 41007 | 1023 |
| 41008 | 1023 |
| 41009 | 1023 |
| 41010 | 1023 |
| 41011 | 1023 |
| 41012 | 1023 |
| 41013 | 1023 |
| 41014 | 1023 |
| 41015 | 1023 |
| 41016 | 1023 |
| 41017 | 1023 |
| 41018 | 1023 |
| 41019 | 1023 |
| 41020 | 1023 |
| 41021 | 1023 |
| 41022 | 1023 |
| 41023 | 1023 |
| 41024 | 1023 |
| 41025 | 1023 |
| 41026 | 1023 |
| 41027 | 1023 |
| 41028 | 1023 |
| 41029 | 0 |
| 41030 | 0 |
| 41031 | 0 |
| 41032 | 0 |
| 41033 | 0 |
| 41034 | 0 |
| 41035 | 0 |
| 41036 | 0 |
| 41037 | 0 |
| 41038 | 0 |
| 41039 | 0 |
| 41040 | 0 |
| 41041 | 0 |
| 41042 | 1023 |
| 41043 | 1023 |
| 41044 | 1023 |
| 41045 | 1023 |
| 41046 | 1023 |
| 41047 | 1023 |
| 41048 | 1023 |
| 41049 | 1023 |
| 41050 | 1023 |
| 41051 | 1023 |
| 41052 | 1023 |
| 41053 | 1023 |
| 41054 | 1023 |
| 41055 | 1023 |
| 41056 | 1023 |
| 41057 | 1023 |
| 41058 | 1023 |
| 41059 | 1023 |
| 41060 | 1023 |
| 41061 | 1023 |
| 41062 | 1023 |
| 41063 | 1023 |
| 41064 | 1023 |
| 41065 | 1023 |
| 41066 | 1023 |
| 41067 | 1023 |
| 41068 | 1023 |
| 41069 | 1023 |
| 41070 | 1023 |
| 41071 | 1023 |
| 41072 | 1023 |
| 41073 | 1023 |
| 41074 | 1023 |
| 41075 | 1023 |
| 41076 | 1023 |
| 41077 | 1023 |
| 41078 | 1023 |
| 41079 | 1023 |
| 41080 | 0 |
| 41081 | 0 |
| 41082 | 0 |
| 41083 | 0 |
| 41084 | 0 |
| 41085 | 0 |
| 41086 | 1 |
| 41087 | 0 |
| 41088 | 0 |
| 41089 | 0 |
| 41090 | 0 |
| 41091 | 0 |
| 41092 | 0 |
| 41093 | 1023 |
| 41094 | 1023 |
| 41095 | 1023 |
| 41096 | 1023 |
| 41097 | 1023 |
| 41098 | 1023 |
| 41099 | 1023 |
| 41100 | 1023 |
| 41101 | 1023 |
| 41102 | 1023 |
| 41103 | 1023 |
| 41104 | 1023 |
| 41105 | 1023 |
| 41106 | 1023 |
| 41107 | 1023 |
| 41108 | 1023 |
| 41109 | 1023 |
| 41110 | 1023 |
| 41111 | 1023 |
| 41112 | 1023 |
| 41113 | 1023 |
| 41114 | 1023 |
| 41115 | 1023 |
| 41116 | 1023 |
| 41117 | 1023 |
| 41118 | 1023 |
| 41119 | 1023 |
| 41120 | 1023 |
| 41121 | 1023 |
| 41122 | 1023 |
| 41123 | 1023 |
| 41124 | 1023 |
| 41125 | 1023 |
| 41126 | 1023 |
| 41127 | 1023 |
| 41128 | 1023 |
| 41129 | 1023 |
| 41130 | 1023 |
| 41131 | 0 |
| 41132 | 0 |
| 41133 | 0 |
| 41134 | 0 |
| 41135 | 0 |
| 41136 | 0 |
| 41137 | 0 |
| 41138 | 0 |
| 41139 | 0 |
| 41140 | 0 |
| 41141 | 0 |
| 41142 | 0 |
| 41143 | 0 |
| 41144 | 0 |
| 41145 | 1023 |
| 41146 | 1023 |
| 41147 | 1023 |
| 41148 | 1023 |
| 41149 | 1023 |
| 41150 | 1023 |
| 41151 | 1023 |
| 41152 | 1023 |
| 41153 | 1023 |
| 41154 | 1023 |
| 41155 | 1023 |
| 41156 | 1023 |
| 41157 | 1023 |
| 41158 | 1023 |
| 41159 | 1023 |
| 41160 | 1023 |
| 41161 | 1023 |
| 41162 | 1023 |
| 41163 | 1023 |
| 41164 | 1023 |
| 41165 | 1023 |
| 41166 | 1023 |
| 41167 | 1023 |
| 41168 | 1023 |
| 41169 | 1023 |
| 41170 | 1023 |
| 41171 | 1023 |
| 41172 | 1023 |
| 41173 | 1023 |
| 41174 | 1023 |
| 41175 | 1023 |
| 41176 | 1023 |
| 41177 | 1023 |
| 41178 | 1023 |
| 41179 | 1023 |
| 41180 | 1023 |
| 41181 | 1023 |
| 41182 | 0 |
| 41183 | 0 |
| 41184 | 0 |
| 41185 | 0 |
| 41186 | 0 |
| 41187 | 0 |
| 41188 | 0 |
| 41189 | 0 |
| 41190 | 0 |
| 41191 | 0 |
| 41192 | 0 |
| 41193 | 0 |
| 41194 | 0 |
| 41195 | 0 |
| 41196 | 1023 |
| 41197 | 1023 |
| 41198 | 1023 |
| 41199 | 1023 |
| 41200 | 1023 |
| 41201 | 1023 |
| 41202 | 1023 |
| 41203 | 1023 |
| 41204 | 1023 |
| 41205 | 1023 |
| 41206 | 1023 |
| 41207 | 1023 |
| 41208 | 1023 |
| 41209 | 1023 |
| 41210 | 1023 |
| 41211 | 1023 |
| 41212 | 1023 |
| 41213 | 1023 |
| 41214 | 1023 |
| 41215 | 1023 |
| 41216 | 1023 |
| 41217 | 1023 |
| 41218 | 1023 |
| 41219 | 1023 |
| 41220 | 1023 |
| 41221 | 1023 |
| 41222 | 1023 |
| 41223 | 1023 |
| 41224 | 1023 |
| 41225 | 1023 |
| 41226 | 1023 |
| 41227 | 1023 |
| 41228 | 1023 |
| 41229 | 1023 |
| 41230 | 1023 |
| 41231 | 1023 |
| 41232 | 1023 |
| 41233 | 1023 |
| 41234 | 0 |
| 41235 | 0 |
| 41236 | 0 |
| 41237 | 0 |
| 41238 | 0 |
| 41239 | 0 |
| 41240 | 0 |
| 41241 | 0 |
| 41242 | 0 |
| 41243 | 0 |
| 41244 | 0 |
| 41245 | 0 |
| 41246 | 0 |
| 41247 | 0 |
| 41248 | 1023 |
| 41249 | 1023 |
| 41250 | 1023 |
| 41251 | 1023 |
| 41252 | 1023 |
| 41253 | 1023 |
| 41254 | 1023 |
| 41255 | 1023 |
| 41256 | 1023 |
| 41257 | 1023 |
| 41258 | 1023 |
| 41259 | 1023 |
| 41260 | 1023 |
| 41261 | 1023 |
| 41262 | 1023 |
| 41263 | 1023 |
| 41264 | 1023 |
| 41265 | 1023 |
| 41266 | 1023 |
| 41267 | 1023 |
| 41268 | 1023 |
| 41269 | 1023 |
| 41270 | 1023 |
| 41271 | 1023 |
| 41272 | 1023 |
| 41273 | 1023 |
| 41274 | 1023 |
| 41275 | 1023 |
| 41276 | 1023 |
| 41277 | 1023 |
| 41278 | 1023 |
| 41279 | 1023 |
| 41280 | 1023 |
| 41281 | 1023 |
| 41282 | 1023 |
| 41283 | 1023 |
| 41284 | 1023 |
| 41285 | 0 |
| 41286 | 0 |
| 41287 | 0 |
| 41288 | 0 |
| 41289 | 0 |
| 41290 | 0 |
| 41291 | 0 |
| 41292 | 0 |
| 41293 | 0 |
| 41294 | 0 |
| 41295 | 0 |
| 41296 | 0 |
| 41297 | 0 |
| 41298 | 0 |
| 41299 | 0 |
| 41300 | 1023 |
| 41301 | 1023 |
| 41302 | 1023 |
| 41303 | 1023 |
| 41304 | 1023 |
| 41305 | 1023 |
| 41306 | 1023 |
| 41307 | 1023 |
| 41308 | 1023 |
| 41309 | 1023 |
| 41310 | 1023 |
| 41311 | 1023 |
| 41312 | 1023 |
| 41313 | 1023 |
| 41314 | 1023 |
| 41315 | 1023 |
| 41316 | 1023 |
| 41317 | 1023 |
| 41318 | 1023 |
| 41319 | 1023 |
| 41320 | 1023 |
| 41321 | 1023 |
| 41322 | 1023 |
| 41323 | 1023 |
| 41324 | 1023 |
| 41325 | 1023 |
| 41326 | 1023 |
| 41327 | 1023 |
| 41328 | 1023 |
| 41329 | 1023 |
| 41330 | 1023 |
| 41331 | 1023 |
| 41332 | 1023 |
| 41333 | 1023 |
| 41334 | 1023 |
| 41335 | 1023 |
| 41336 | 1023 |
| 41337 | 0 |
| 41338 | 0 |
| 41339 | 0 |
| 41340 | 0 |
| 41341 | 0 |
| 41342 | 0 |
| 41343 | 0 |
| 41344 | 0 |
| 41345 | 0 |
| 41346 | 0 |
| 41347 | 0 |
| 41348 | 0 |
| 41349 | 0 |
| 41350 | 0 |
| 41351 | 0 |
| 41352 | 1023 |
| 41353 | 1023 |
| 41354 | 1023 |
| 41355 | 1023 |
| 41356 | 1023 |
| 41357 | 1023 |
| 41358 | 1023 |
| 41359 | 1023 |
| 41360 | 1023 |
| 41361 | 1023 |
| 41362 | 1023 |
| 41363 | 1023 |
| 41364 | 1023 |
| 41365 | 1023 |
| 41366 | 1023 |
| 41367 | 1023 |
| 41368 | 1023 |
| 41369 | 1023 |
| 41370 | 1023 |
| 41371 | 1023 |
| 41372 | 1023 |
| 41373 | 1023 |
| 41374 | 1023 |
| 41375 | 1023 |
| 41376 | 1023 |
| 41377 | 1023 |
| 41378 | 1023 |
| 41379 | 1023 |
| 41380 | 1023 |
| 41381 | 1023 |
| 41382 | 1023 |
| 41383 | 1023 |
| 41384 | 1023 |
| 41385 | 1023 |
| 41386 | 1023 |
| 41387 | 1023 |
| 41388 | 1023 |
| 41389 | 0 |
| 41390 | 0 |
| 41391 | 0 |
| 41392 | 0 |
| 41393 | 0 |
| 41394 | 0 |
| 41395 | 0 |
| 41396 | 0 |
| 41397 | 0 |
| 41398 | 0 |
| 41399 | 0 |
| 41400 | 0 |
| 41401 | 0 |
| 41402 | 0 |
| 41403 | 0 |
| 41404 | 1023 |
| 41405 | 1023 |
| 41406 | 1023 |
| 41407 | 1023 |
| 41408 | 1023 |
| 41409 | 1023 |
| 41410 | 1023 |
| 41411 | 1023 |
| 41412 | 1023 |
| 41413 | 1023 |
| 41414 | 1023 |
| 41415 | 1023 |
| 41416 | 1023 |
| 41417 | 1023 |
| 41418 | 1023 |
| 41419 | 1023 |
| 41420 | 1023 |
| 41421 | 1023 |
| 41422 | 1023 |
| 41423 | 1023 |
| 41424 | 1023 |
| 41425 | 1023 |
| 41426 | 1023 |
| 41427 | 1023 |
| 41428 | 1023 |
| 41429 | 1023 |
| 41430 | 1023 |
| 41431 | 1023 |
| 41432 | 1023 |
| 41433 | 1023 |
| 41434 | 1023 |
| 41435 | 1023 |
| 41436 | 1023 |
| 41437 | 1023 |
| 41438 | 1023 |
| 41439 | 1023 |
| 41440 | 1023 |
| 41441 | 0 |
| 41442 | 0 |
| 41443 | 0 |
| 41444 | 0 |
| 41445 | 0 |
| 41446 | 0 |
| 41447 | 0 |
| 41448 | 0 |
| 41449 | 0 |
| 41450 | 0 |
| 41451 | 0 |
| 41452 | 0 |
| 41453 | 0 |
| 41454 | 0 |
| 41455 | 0 |
| 41456 | 1023 |
| 41457 | 1023 |
| 41458 | 1023 |
| 41459 | 1023 |
| 41460 | 1023 |
| 41461 | 1023 |
| 41462 | 1023 |
| 41463 | 1023 |
| 41464 | 1023 |
| 41465 | 1023 |
| 41466 | 1023 |
| 41467 | 1023 |
| 41468 | 1023 |
| 41469 | 1023 |
| 41470 | 1023 |
| 41471 | 1023 |
| 41472 | 1023 |
| 41473 | 1023 |
| 41474 | 1023 |
| 41475 | 1023 |
| 41476 | 1023 |
| 41477 | 1023 |
| 41478 | 1023 |
| 41479 | 1023 |
| 41480 | 1023 |
| 41481 | 1023 |
| 41482 | 1023 |
| 41483 | 1023 |
| 41484 | 1023 |
| 41485 | 1023 |
| 41486 | 1023 |
| 41487 | 1023 |
| 41488 | 1023 |
| 41489 | 1023 |
| 41490 | 1023 |
| 41491 | 1023 |
| 41492 | 1023 |
| 41493 | 1023 |
| 41494 | 0 |
| 41495 | 0 |
| 41496 | 0 |
| 41497 | 0 |
| 41498 | 0 |
| 41499 | 0 |
| 41500 | 0 |
| 41501 | 0 |
| 41502 | 0 |
| 41503 | 0 |
| 41504 | 0 |
| 41505 | 0 |
| 41506 | 0 |
| 41507 | 1023 |
| 41508 | 1023 |
| 41509 | 1023 |
| 41510 | 1023 |
| 41511 | 1023 |
| 41512 | 1023 |
| 41513 | 1023 |
| 41514 | 1023 |
| 41515 | 1023 |
| 41516 | 1023 |
| 41517 | 1023 |
| 41518 | 1023 |
| 41519 | 1023 |
| 41520 | 1023 |
| 41521 | 1023 |
| 41522 | 1023 |
| 41523 | 1023 |
| 41524 | 1023 |
| 41525 | 1023 |
| 41526 | 1023 |
| 41527 | 1023 |
| 41528 | 1023 |
| 41529 | 1023 |
| 41530 | 1023 |
| 41531 | 1023 |
| 41532 | 1023 |
| 41533 | 1023 |
| 41534 | 1023 |
| 41535 | 1023 |
| 41536 | 1023 |
| 41537 | 1023 |
| 41538 | 1023 |
| 41539 | 1023 |
| 41540 | 1023 |
| 41541 | 1023 |
| 41542 | 1023 |
| 41543 | 1023 |
| 41544 | 1023 |
| 41545 | 0 |
| 41546 | 0 |
| 41547 | 0 |
| 41548 | 0 |
| 41549 | 0 |
| 41550 | 0 |
| 41551 | 0 |
| 41552 | 0 |
| 41553 | 0 |
| 41554 | 0 |
| 41555 | 0 |
| 41556 | 0 |
| 41557 | 0 |
| 41558 | 1023 |
| 41559 | 1023 |
| 41560 | 1023 |
| 41561 | 1023 |
| 41562 | 1023 |
| 41563 | 1023 |
| 41564 | 1023 |
| 41565 | 1023 |
| 41566 | 1023 |
| 41567 | 1023 |
| 41568 | 1023 |
| 41569 | 1023 |
| 41570 | 1023 |
| 41571 | 1023 |
| 41572 | 1023 |
| 41573 | 1023 |
| 41574 | 1023 |
| 41575 | 1023 |
| 41576 | 1023 |
| 41577 | 1023 |
| 41578 | 1023 |
| 41579 | 1023 |
| 41580 | 1023 |
| 41581 | 1023 |
| 41582 | 1023 |
| 41583 | 1023 |
| 41584 | 1023 |
| 41585 | 1023 |
| 41586 | 1023 |
| 41587 | 1023 |
| 41588 | 1023 |
| 41589 | 1023 |
| 41590 | 1023 |
| 41591 | 1023 |
| 41592 | 1023 |
| 41593 | 1023 |
| 41594 | 1023 |
| 41595 | 1023 |
| 41596 | 0 |
| 41597 | 0 |
| 41598 | 0 |
| 41599 | 0 |
| 41600 | 0 |
| 41601 | 0 |
| 41602 | 0 |
| 41603 | 0 |
| 41604 | 0 |
| 41605 | 0 |
| 41606 | 0 |
| 41607 | 0 |
| 41608 | 0 |
| 41609 | 1023 |
| 41610 | 1023 |
| 41611 | 1023 |
| 41612 | 1023 |
| 41613 | 1023 |
| 41614 | 1023 |
| 41615 | 1023 |
| 41616 | 1023 |
| 41617 | 1023 |
| 41618 | 1023 |
| 41619 | 1023 |
| 41620 | 1023 |
| 41621 | 1023 |
| 41622 | 1023 |
| 41623 | 1023 |
| 41624 | 1023 |
| 41625 | 1023 |
| 41626 | 1023 |
| 41627 | 1023 |
| 41628 | 1023 |
| 41629 | 1023 |
| 41630 | 1023 |
| 41631 | 1023 |
| 41632 | 1023 |
| 41633 | 1023 |
| 41634 | 1023 |
| 41635 | 1023 |
| 41636 | 1023 |
| 41637 | 1023 |
| 41638 | 1023 |
| 41639 | 1023 |
| 41640 | 1023 |
| 41641 | 1023 |
| 41642 | 1023 |
| 41643 | 1023 |
| 41644 | 1023 |
| 41645 | 1023 |
| 41646 | 1023 |
| 41647 | 0 |
| 41648 | 0 |
| 41649 | 0 |
| 41650 | 0 |
| 41651 | 0 |
| 41652 | 0 |
| 41653 | 0 |
| 41654 | 0 |
| 41655 | 0 |
| 41656 | 0 |
| 41657 | 0 |
| 41658 | 0 |
| 41659 | 0 |
| 41660 | 1023 |
| 41661 | 1023 |
| 41662 | 1023 |
| 41663 | 1023 |
| 41664 | 1023 |
| 41665 | 1023 |
| 41666 | 1023 |
| 41667 | 1023 |
| 41668 | 1023 |
| 41669 | 1023 |
| 41670 | 1023 |
| 41671 | 1023 |
| 41672 | 1023 |
| 41673 | 1023 |
| 41674 | 1023 |
| 41675 | 1023 |
| 41676 | 1023 |
| 41677 | 1023 |
| 41678 | 1023 |
| 41679 | 1023 |
| 41680 | 1023 |
| 41681 | 1023 |
| 41682 | 1023 |
| 41683 | 1023 |
| 41684 | 1023 |
| 41685 | 1023 |
| 41686 | 1023 |
| 41687 | 1023 |
| 41688 | 1023 |
| 41689 | 1023 |
| 41690 | 1023 |
| 41691 | 1023 |
| 41692 | 1023 |
| 41693 | 1023 |
| 41694 | 1023 |
| 41695 | 1023 |
| 41696 | 1023 |
| 41697 | 1023 |
| 41698 | 0 |
| 41699 | 0 |
| 41700 | 0 |
| 41701 | 0 |
| 41702 | 0 |
| 41703 | 0 |
| 41704 | 0 |
| 41705 | 0 |
| 41706 | 0 |
| 41707 | 0 |
| 41708 | 0 |
| 41709 | 0 |
| 41710 | 0 |
| 41711 | 1023 |
| 41712 | 1023 |
| 41713 | 1023 |
| 41714 | 1023 |
| 41715 | 1023 |
| 41716 | 1023 |
| 41717 | 1023 |
| 41718 | 1023 |
| 41719 | 1023 |
| 41720 | 1023 |
| 41721 | 1023 |
| 41722 | 1023 |
| 41723 | 1023 |
| 41724 | 1023 |
| 41725 | 1023 |
| 41726 | 1023 |
| 41727 | 1023 |
| 41728 | 1023 |
| 41729 | 1023 |
| 41730 | 1023 |
| 41731 | 1023 |
| 41732 | 1023 |
| 41733 | 1023 |
| 41734 | 1023 |
| 41735 | 1023 |
| 41736 | 1023 |
| 41737 | 1023 |
| 41738 | 1023 |
| 41739 | 1023 |
| 41740 | 1023 |
| 41741 | 1023 |
| 41742 | 1023 |
| 41743 | 1023 |
| 41744 | 1023 |
| 41745 | 1023 |
| 41746 | 1023 |
| 41747 | 1023 |
| 41748 | 1023 |
| 41749 | 0 |
| 41750 | 0 |
| 41751 | 0 |
| 41752 | 0 |
| 41753 | 0 |
| 41754 | 0 |
| 41755 | 0 |
| 41756 | 0 |
| 41757 | 0 |
| 41758 | 0 |
| 41759 | 0 |
| 41760 | 0 |
| 41761 | 0 |
| 41762 | 0 |
| 41763 | 1023 |
| 41764 | 1023 |
| 41765 | 1023 |
| 41766 | 1023 |
| 41767 | 1023 |
| 41768 | 1023 |
| 41769 | 1023 |
| 41770 | 1023 |
| 41771 | 1023 |
| 41772 | 1023 |
| 41773 | 1023 |
| 41774 | 1023 |
| 41775 | 1023 |
| 41776 | 1023 |
| 41777 | 1023 |
| 41778 | 1023 |
| 41779 | 1023 |
| 41780 | 1023 |
| 41781 | 1023 |
| 41782 | 1023 |
| 41783 | 1023 |
| 41784 | 1023 |
| 41785 | 1023 |
| 41786 | 1023 |
| 41787 | 1023 |
| 41788 | 1023 |
| 41789 | 1023 |
| 41790 | 1023 |
| 41791 | 1023 |
| 41792 | 1023 |
| 41793 | 1023 |
| 41794 | 1023 |
| 41795 | 1023 |
| 41796 | 1023 |
| 41797 | 1023 |
| 41798 | 1023 |
| 41799 | 1023 |
| 41800 | 0 |
| 41801 | 0 |
| 41802 | 0 |
| 41803 | 0 |
| 41804 | 0 |
| 41805 | 0 |
| 41806 | 0 |
| 41807 | 0 |
| 41808 | 0 |
| 41809 | 0 |
| 41810 | 0 |
| 41811 | 0 |
| 41812 | 0 |
| 41813 | 0 |
| 41814 | 1023 |
| 41815 | 1023 |
| 41816 | 1023 |
| 41817 | 1023 |
| 41818 | 1023 |
| 41819 | 1023 |
| 41820 | 1023 |
| 41821 | 1023 |
| 41822 | 1023 |
| 41823 | 1023 |
| 41824 | 1023 |
| 41825 | 1023 |
| 41826 | 1023 |
| 41827 | 1023 |
| 41828 | 1023 |
| 41829 | 1023 |
| 41830 | 1023 |
| 41831 | 1023 |
| 41832 | 1023 |
| 41833 | 1023 |
| 41834 | 1023 |
| 41835 | 1023 |
| 41836 | 1023 |
| 41837 | 1023 |
| 41838 | 1023 |
| 41839 | 1023 |
| 41840 | 1023 |
| 41841 | 1023 |
| 41842 | 1023 |
| 41843 | 1023 |
| 41844 | 1023 |
| 41845 | 1023 |
| 41846 | 1023 |
| 41847 | 1023 |
| 41848 | 1023 |
| 41849 | 1023 |
| 41850 | 1023 |
| 41851 | 1023 |
| 41852 | 0 |
| 41853 | 0 |
| 41854 | 0 |
| 41855 | 0 |
| 41856 | 0 |
| 41857 | 0 |
| 41858 | 0 |
| 41859 | 0 |
| 41860 | 0 |
| 41861 | 0 |
| 41862 | 0 |
| 41863 | 0 |
| 41864 | 0 |
| 41865 | 0 |
| 41866 | 1023 |
| 41867 | 1023 |
| 41868 | 1023 |
| 41869 | 1023 |
| 41870 | 1023 |
| 41871 | 1023 |
| 41872 | 1023 |
| 41873 | 1023 |
| 41874 | 1023 |
| 41875 | 1023 |
| 41876 | 1023 |
| 41877 | 1023 |
| 41878 | 1023 |
| 41879 | 1023 |
| 41880 | 1023 |
| 41881 | 1023 |
| 41882 | 1023 |
| 41883 | 1023 |
| 41884 | 1023 |
| 41885 | 1023 |
| 41886 | 1023 |
| 41887 | 1023 |
| 41888 | 1023 |
| 41889 | 1023 |
| 41890 | 1023 |
| 41891 | 1023 |
| 41892 | 1023 |
| 41893 | 1023 |
| 41894 | 1023 |
| 41895 | 1023 |
| 41896 | 1023 |
| 41897 | 1023 |
| 41898 | 1023 |
| 41899 | 1023 |
| 41900 | 1023 |
| 41901 | 1023 |
| 41902 | 1023 |
| 41903 | 0 |
| 41904 | 0 |
| 41905 | 0 |
| 41906 | 0 |
| 41907 | 0 |
| 41908 | 0 |
| 41909 | 0 |
| 41910 | 0 |
| 41911 | 0 |
| 41912 | 0 |
| 41913 | 0 |
| 41914 | 0 |
| 41915 | 0 |
| 41916 | 0 |
| 41917 | 0 |
| 41918 | 1023 |
| 41919 | 1023 |
| 41920 | 1023 |
| 41921 | 1023 |
| 41922 | 1023 |
| 41923 | 1023 |
| 41924 | 1023 |
| 41925 | 1023 |
| 41926 | 1023 |
| 41927 | 1023 |
| 41928 | 1023 |
| 41929 | 1023 |
| 41930 | 1023 |
| 41931 | 1023 |
| 41932 | 1023 |
| 41933 | 1023 |
| 41934 | 1023 |
| 41935 | 1023 |
| 41936 | 1023 |
| 41937 | 1023 |
| 41938 | 1023 |
| 41939 | 1023 |
| 41940 | 1023 |
| 41941 | 1023 |
| 41942 | 1023 |
| 41943 | 1023 |
| 41944 | 1023 |
| 41945 | 1023 |
| 41946 | 1023 |
| 41947 | 1023 |
| 41948 | 1023 |
| 41949 | 1023 |
| 41950 | 1023 |
| 41951 | 1023 |
| 41952 | 1023 |
| 41953 | 1023 |
| 41954 | 1023 |
| 41955 | 0 |
| 41956 | 0 |
| 41957 | 0 |
| 41958 | 0 |
| 41959 | 0 |
| 41960 | 0 |
| 41961 | 0 |
| 41962 | 0 |
| 41963 | 0 |
| 41964 | 0 |
| 41965 | 0 |
| 41966 | 0 |
| 41967 | 0 |
| 41968 | 0 |
| 41969 | 0 |
| 41970 | 1023 |
| 41971 | 1023 |
| 41972 | 1023 |
| 41973 | 1023 |
| 41974 | 1023 |
| 41975 | 1023 |
| 41976 | 1023 |
| 41977 | 1023 |
| 41978 | 1023 |
| 41979 | 1023 |
| 41980 | 1023 |
| 41981 | 1023 |
| 41982 | 1023 |
| 41983 | 1023 |
| 41984 | 1023 |
| 41985 | 1023 |
| 41986 | 1023 |
| 41987 | 1023 |
| 41988 | 1023 |
| 41989 | 1023 |
| 41990 | 1023 |
| 41991 | 1023 |
| 41992 | 1023 |
| 41993 | 1023 |
| 41994 | 1023 |
| 41995 | 1023 |
| 41996 | 1023 |
| 41997 | 1023 |
| 41998 | 1023 |
| 41999 | 1023 |
| 42000 | 1023 |
| 42001 | 1023 |
| 42002 | 1023 |
| 42003 | 1023 |
| 42004 | 1023 |
| 42005 | 1023 |
| 42006 | 1023 |
| 42007 | 0 |
| 42008 | 0 |
| 42009 | 0 |
| 42010 | 0 |
| 42011 | 0 |
| 42012 | 0 |
| 42013 | 0 |
| 42014 | 0 |
| 42015 | 0 |
| 42016 | 0 |
| 42017 | 0 |
| 42018 | 0 |
| 42019 | 0 |
| 42020 | 0 |
| 42021 | 0 |
| 42022 | 1023 |
| 42023 | 1023 |
| 42024 | 1023 |
| 42025 | 1023 |
| 42026 | 1023 |
| 42027 | 1023 |
| 42028 | 1023 |
| 42029 | 1023 |
| 42030 | 1023 |
| 42031 | 1023 |
| 42032 | 1023 |
| 42033 | 1023 |
| 42034 | 1023 |
| 42035 | 1023 |
| 42036 | 1023 |
| 42037 | 1023 |
| 42038 | 1023 |
| 42039 | 1023 |
| 42040 | 1023 |
| 42041 | 1023 |
| 42042 | 1023 |
| 42043 | 1023 |
| 42044 | 1023 |
| 42045 | 1023 |
| 42046 | 1023 |
| 42047 | 1023 |
| 42048 | 1023 |
| 42049 | 1023 |
| 42050 | 1023 |
| 42051 | 1023 |
| 42052 | 1023 |
| 42053 | 1023 |
| 42054 | 1023 |
| 42055 | 1023 |
| 42056 | 1023 |
| 42057 | 1023 |
| 42058 | 1023 |
| 42059 | 1023 |
| 42060 | 0 |
| 42061 | 0 |
| 42062 | 0 |
| 42063 | 0 |
| 42064 | 0 |
| 42065 | 0 |
| 42066 | 0 |
| 42067 | 1 |
| 42068 | 0 |
| 42069 | 0 |
| 42070 | 0 |
| 42071 | 0 |
| 42072 | 0 |
| 42073 | 1023 |
| 42074 | 1023 |
| 42075 | 1023 |
| 42076 | 1023 |
| 42077 | 1023 |
| 42078 | 1023 |
| 42079 | 1023 |
| 42080 | 1023 |
| 42081 | 1023 |
| 42082 | 1023 |
| 42083 | 1023 |
| 42084 | 1023 |
| 42085 | 1023 |
| 42086 | 1023 |
| 42087 | 1023 |
| 42088 | 1023 |
| 42089 | 1023 |
| 42090 | 1023 |
| 42091 | 1023 |
| 42092 | 1023 |
| 42093 | 1023 |
| 42094 | 1023 |
| 42095 | 1023 |
| 42096 | 1023 |
| 42097 | 1023 |
| 42098 | 1023 |
| 42099 | 1023 |
| 42100 | 1023 |
| 42101 | 1023 |
| 42102 | 1023 |
| 42103 | 1023 |
| 42104 | 1023 |
| 42105 | 1023 |
| 42106 | 1023 |
| 42107 | 1023 |
| 42108 | 1023 |
| 42109 | 1023 |
| 42110 | 1023 |
| 42111 | 0 |
| 42112 | 0 |
| 42113 | 0 |
| 42114 | 0 |
| 42115 | 0 |
| 42116 | 0 |
| 42117 | 0 |
| 42118 | 0 |
| 42119 | 0 |
| 42120 | 0 |
| 42121 | 0 |
| 42122 | 0 |
| 42123 | 0 |
| 42124 | 1023 |
| 42125 | 1023 |
| 42126 | 1023 |
| 42127 | 1023 |
| 42128 | 1023 |
| 42129 | 1023 |
| 42130 | 1023 |
| 42131 | 1023 |
| 42132 | 1023 |
| 42133 | 1023 |
| 42134 | 1023 |
| 42135 | 1023 |
| 42136 | 1023 |
| 42137 | 1023 |
| 42138 | 1023 |
| 42139 | 1023 |
| 42140 | 1023 |
| 42141 | 1023 |
| 42142 | 1023 |
| 42143 | 1023 |
| 42144 | 1023 |
| 42145 | 1023 |
| 42146 | 1023 |
| 42147 | 1023 |
| 42148 | 1023 |
| 42149 | 1023 |
| 42150 | 1023 |
| 42151 | 1023 |
| 42152 | 1023 |
| 42153 | 1023 |
| 42154 | 1023 |
| 42155 | 1023 |
| 42156 | 1023 |
| 42157 | 1023 |
| 42158 | 1023 |
| 42159 | 1023 |
| 42160 | 1023 |
| 42161 | 1023 |
| 42162 | 0 |
| 42163 | 0 |
| 42164 | 0 |
| 42165 | 0 |
| 42166 | 0 |
| 42167 | 0 |
| 42168 | 0 |
| 42169 | 0 |
| 42170 | 0 |
| 42171 | 0 |
| 42172 | 0 |
| 42173 | 0 |
| 42174 | 0 |
| 42175 | 1023 |
| 42176 | 1023 |
| 42177 | 1023 |
| 42178 | 1023 |
| 42179 | 1023 |
| 42180 | 1023 |
| 42181 | 1023 |
| 42182 | 1023 |
| 42183 | 1023 |
| 42184 | 1023 |
| 42185 | 1023 |
| 42186 | 1023 |
| 42187 | 1023 |
| 42188 | 1023 |
| 42189 | 1023 |
| 42190 | 1023 |
| 42191 | 1023 |
| 42192 | 1023 |
| 42193 | 1023 |
| 42194 | 1023 |
| 42195 | 1023 |
| 42196 | 1023 |
| 42197 | 1023 |
| 42198 | 1023 |
| 42199 | 1023 |
| 42200 | 1023 |
| 42201 | 1023 |
| 42202 | 1023 |
| 42203 | 1023 |
| 42204 | 1023 |
| 42205 | 1023 |
| 42206 | 1023 |
| 42207 | 1023 |
| 42208 | 1023 |
| 42209 | 1023 |
| 42210 | 1023 |
| 42211 | 1023 |
| 42212 | 1023 |
| 42213 | 0 |
| 42214 | 0 |
| 42215 | 0 |
| 42216 | 0 |
| 42217 | 0 |
| 42218 | 0 |
| 42219 | 0 |
| 42220 | 0 |
| 42221 | 0 |
| 42222 | 0 |
| 42223 | 0 |
| 42224 | 0 |
| 42225 | 0 |
| 42226 | 1023 |
| 42227 | 1023 |
| 42228 | 1023 |
| 42229 | 1023 |
| 42230 | 1023 |
| 42231 | 1023 |
| 42232 | 1023 |
| 42233 | 1023 |
| 42234 | 1023 |
| 42235 | 1023 |
| 42236 | 1023 |
| 42237 | 1023 |
| 42238 | 1023 |
| 42239 | 1023 |
| 42240 | 1023 |
| 42241 | 1023 |
| 42242 | 1023 |
| 42243 | 1023 |
| 42244 | 1023 |
| 42245 | 1023 |
| 42246 | 1023 |
| 42247 | 1023 |
| 42248 | 1023 |
| 42249 | 1023 |
| 42250 | 1023 |
| 42251 | 1023 |
| 42252 | 1023 |
| 42253 | 1023 |
| 42254 | 1023 |
| 42255 | 1023 |
| 42256 | 1023 |
| 42257 | 1023 |
| 42258 | 1023 |
| 42259 | 1023 |
| 42260 | 1023 |
| 42261 | 1023 |
| 42262 | 1023 |
| 42263 | 1023 |
| 42264 | 0 |
| 42265 | 0 |
| 42266 | 0 |
| 42267 | 0 |
| 42268 | 0 |
| 42269 | 0 |
| 42270 | 0 |
| 42271 | 0 |
| 42272 | 0 |
| 42273 | 0 |
| 42274 | 0 |
| 42275 | 0 |
| 42276 | 0 |
| 42277 | 1023 |
| 42278 | 1023 |
| 42279 | 1023 |
| 42280 | 1023 |
| 42281 | 1023 |
| 42282 | 1023 |
| 42283 | 1023 |
| 42284 | 1023 |
| 42285 | 1023 |
| 42286 | 1023 |
| 42287 | 1023 |
| 42288 | 1023 |
| 42289 | 1023 |
| 42290 | 1023 |
| 42291 | 1023 |
| 42292 | 1023 |
| 42293 | 1023 |
| 42294 | 1023 |
| 42295 | 1023 |
| 42296 | 1023 |
| 42297 | 1023 |
| 42298 | 1023 |
| 42299 | 1023 |
| 42300 | 1023 |
| 42301 | 1023 |
| 42302 | 1023 |
| 42303 | 1023 |
| 42304 | 1023 |
| 42305 | 1023 |
| 42306 | 1023 |
| 42307 | 1023 |
| 42308 | 1023 |
| 42309 | 1023 |
| 42310 | 1023 |
| 42311 | 1023 |
| 42312 | 1023 |
| 42313 | 1023 |
| 42314 | 1023 |
| 42315 | 0 |
| 42316 | 0 |
| 42317 | 0 |
| 42318 | 0 |
| 42319 | 0 |
| 42320 | 0 |
| 42321 | 0 |
| 42322 | 0 |
| 42323 | 0 |
| 42324 | 0 |
| 42325 | 0 |
| 42326 | 0 |
| 42327 | 0 |
| 42328 | 1023 |
| 42329 | 1023 |
| 42330 | 1023 |
| 42331 | 1023 |
| 42332 | 1023 |
| 42333 | 1023 |
| 42334 | 1023 |
| 42335 | 1023 |
| 42336 | 1023 |
| 42337 | 1023 |
| 42338 | 1023 |
| 42339 | 1023 |
| 42340 | 1023 |
| 42341 | 1023 |
| 42342 | 1023 |
| 42343 | 1023 |
| 42344 | 1023 |
| 42345 | 1023 |
| 42346 | 1023 |
| 42347 | 1023 |
| 42348 | 1023 |
| 42349 | 1023 |
| 42350 | 1023 |
| 42351 | 1023 |
| 42352 | 1023 |
| 42353 | 1023 |
| 42354 | 1023 |
| 42355 | 1023 |
| 42356 | 1023 |
| 42357 | 1023 |
| 42358 | 1023 |
| 42359 | 1023 |
| 42360 | 1023 |
| 42361 | 1023 |
| 42362 | 1023 |
| 42363 | 1023 |
| 42364 | 1023 |
| 42365 | 1023 |
| 42366 | 0 |
| 42367 | 0 |
| 42368 | 0 |
| 42369 | 0 |
| 42370 | 0 |
| 42371 | 0 |
| 42372 | 0 |
| 42373 | 0 |
| 42374 | 0 |
| 42375 | 0 |
| 42376 | 0 |
| 42377 | 0 |
| 42378 | 0 |
| 42379 | 0 |
| 42380 | 1023 |
| 42381 | 1023 |
| 42382 | 1023 |
| 42383 | 1023 |
| 42384 | 1023 |
| 42385 | 1023 |
| 42386 | 1023 |
| 42387 | 1023 |
| 42388 | 1023 |
| 42389 | 1023 |
| 42390 | 1023 |
| 42391 | 1023 |
| 42392 | 1023 |
| 42393 | 1023 |
| 42394 | 1023 |
| 42395 | 1023 |
| 42396 | 1023 |
| 42397 | 1023 |
| 42398 | 1023 |
| 42399 | 1023 |
| 42400 | 1023 |
| 42401 | 1023 |
| 42402 | 1023 |
| 42403 | 1023 |
| 42404 | 1023 |
| 42405 | 1023 |
| 42406 | 1023 |
| 42407 | 1023 |
| 42408 | 1023 |
| 42409 | 1023 |
| 42410 | 1023 |
| 42411 | 1023 |
| 42412 | 1023 |
| 42413 | 1023 |
| 42414 | 1023 |
| 42415 | 1023 |
| 42416 | 1023 |
| 42417 | 0 |
| 42418 | 0 |
| 42419 | 0 |
| 42420 | 0 |
| 42421 | 0 |
| 42422 | 0 |
| 42423 | 0 |
| 42424 | 0 |
| 42425 | 0 |
| 42426 | 0 |
| 42427 | 0 |
| 42428 | 0 |
| 42429 | 0 |
| 42430 | 0 |
| 42431 | 1023 |
| 42432 | 1023 |
| 42433 | 1023 |
| 42434 | 1023 |
| 42435 | 1023 |
| 42436 | 1023 |
| 42437 | 1023 |
| 42438 | 1023 |
| 42439 | 1023 |
| 42440 | 1023 |
| 42441 | 1023 |
| 42442 | 1023 |
| 42443 | 1023 |
| 42444 | 1023 |
| 42445 | 1023 |
| 42446 | 1023 |
| 42447 | 1023 |
| 42448 | 1023 |
| 42449 | 1023 |
| 42450 | 1023 |
| 42451 | 1023 |
| 42452 | 1023 |
| 42453 | 1023 |
| 42454 | 1023 |
| 42455 | 1023 |
| 42456 | 1023 |
| 42457 | 1023 |
| 42458 | 1023 |
| 42459 | 1023 |
| 42460 | 1023 |
| 42461 | 1023 |
| 42462 | 1023 |
| 42463 | 1023 |
| 42464 | 1023 |
| 42465 | 1023 |
| 42466 | 1023 |
| 42467 | 1023 |
| 42468 | 1023 |
| 42469 | 0 |
| 42470 | 0 |
| 42471 | 0 |
| 42472 | 0 |
| 42473 | 0 |
| 42474 | 0 |
| 42475 | 0 |
| 42476 | 0 |
| 42477 | 0 |
| 42478 | 0 |
| 42479 | 0 |
| 42480 | 0 |
| 42481 | 0 |
| 42482 | 0 |
| 42483 | 1023 |
| 42484 | 1023 |
| 42485 | 1023 |
| 42486 | 1023 |
| 42487 | 1023 |
| 42488 | 1023 |
| 42489 | 1023 |
| 42490 | 1023 |
| 42491 | 1023 |
| 42492 | 1023 |
| 42493 | 1023 |
| 42494 | 1023 |
| 42495 | 1023 |
| 42496 | 1023 |
| 42497 | 1023 |
| 42498 | 1023 |
| 42499 | 1023 |
| 42500 | 1023 |
| 42501 | 1023 |
| 42502 | 1023 |
| 42503 | 1023 |
| 42504 | 1023 |
| 42505 | 1023 |
| 42506 | 1023 |
| 42507 | 1023 |
| 42508 | 1023 |
| 42509 | 1023 |
| 42510 | 1023 |
| 42511 | 1023 |
| 42512 | 1023 |
| 42513 | 1023 |
| 42514 | 1023 |
| 42515 | 1023 |
| 42516 | 1023 |
| 42517 | 1023 |
| 42518 | 1023 |
| 42519 | 1023 |
| 42520 | 0 |
| 42521 | 0 |
| 42522 | 0 |
| 42523 | 0 |
| 42524 | 0 |
| 42525 | 0 |
| 42526 | 0 |
| 42527 | 0 |
| 42528 | 0 |
| 42529 | 0 |
| 42530 | 0 |
| 42531 | 0 |
| 42532 | 0 |
| 42533 | 0 |
| 42534 | 0 |
| 42535 | 1023 |
| 42536 | 1023 |
| 42537 | 1023 |
| 42538 | 1023 |
| 42539 | 1023 |
| 42540 | 1023 |
| 42541 | 1023 |
| 42542 | 1023 |
| 42543 | 1023 |
| 42544 | 1023 |
| 42545 | 1023 |
| 42546 | 1023 |
| 42547 | 1023 |
| 42548 | 1023 |
| 42549 | 1023 |
| 42550 | 1023 |
| 42551 | 1023 |
| 42552 | 1023 |
| 42553 | 1023 |
| 42554 | 1023 |
| 42555 | 1023 |
| 42556 | 1023 |
| 42557 | 1023 |
| 42558 | 1023 |
| 42559 | 1023 |
| 42560 | 1023 |
| 42561 | 1023 |
| 42562 | 1023 |
| 42563 | 1023 |
| 42564 | 1023 |
| 42565 | 1023 |
| 42566 | 1023 |
| 42567 | 1023 |
| 42568 | 1023 |
| 42569 | 1023 |
| 42570 | 1023 |
| 42571 | 1023 |
| 42572 | 0 |
| 42573 | 0 |
| 42574 | 0 |
| 42575 | 0 |
| 42576 | 0 |
| 42577 | 0 |
| 42578 | 0 |
| 42579 | 0 |
| 42580 | 0 |
| 42581 | 0 |
| 42582 | 0 |
| 42583 | 0 |
| 42584 | 0 |
| 42585 | 0 |
| 42586 | 0 |
| 42587 | 1023 |
| 42588 | 1023 |
| 42589 | 1023 |
| 42590 | 1023 |
| 42591 | 1023 |
| 42592 | 1023 |
| 42593 | 1023 |
| 42594 | 1023 |
| 42595 | 1023 |
| 42596 | 1023 |
| 42597 | 1023 |
| 42598 | 1023 |
| 42599 | 1023 |
| 42600 | 1023 |
| 42601 | 1023 |
| 42602 | 1023 |
| 42603 | 1023 |
| 42604 | 1023 |
| 42605 | 1023 |
| 42606 | 1023 |
| 42607 | 1023 |
| 42608 | 1023 |
| 42609 | 1023 |
| 42610 | 1023 |
| 42611 | 1023 |
| 42612 | 1023 |
| 42613 | 1023 |
| 42614 | 1023 |
| 42615 | 1023 |
| 42616 | 1023 |
| 42617 | 1023 |
| 42618 | 1023 |
| 42619 | 1023 |
| 42620 | 1023 |
| 42621 | 1023 |
| 42622 | 1023 |
| 42623 | 1023 |
| 42624 | 0 |
| 42625 | 0 |
| 42626 | 0 |
| 42627 | 0 |
| 42628 | 0 |
| 42629 | 0 |
| 42630 | 0 |
| 42631 | 0 |
| 42632 | 0 |
| 42633 | 0 |
| 42634 | 0 |
| 42635 | 1 |
| 42636 | 0 |
| 42637 | 0 |
| 42638 | 0 |
| 42639 | 1023 |
| 42640 | 1023 |
| 42641 | 1023 |
| 42642 | 1023 |
| 42643 | 1023 |
| 42644 | 1023 |
| 42645 | 1023 |
| 42646 | 1023 |
| 42647 | 1023 |
| 42648 | 1023 |
| 42649 | 1023 |
| 42650 | 1023 |
| 42651 | 1023 |
| 42652 | 1023 |
| 42653 | 1023 |
| 42654 | 1023 |
| 42655 | 1023 |
| 42656 | 1023 |
| 42657 | 1023 |
| 42658 | 1023 |
| 42659 | 1023 |
| 42660 | 1023 |
| 42661 | 1023 |
| 42662 | 1023 |
| 42663 | 1023 |
| 42664 | 1023 |
| 42665 | 1023 |
| 42666 | 1023 |
| 42667 | 1023 |
| 42668 | 1023 |
| 42669 | 1023 |
| 42670 | 1023 |
| 42671 | 1023 |
| 42672 | 1023 |
| 42673 | 1023 |
| 42674 | 1023 |
| 42675 | 1023 |
| 42676 | 1023 |
| 42677 | 0 |
| 42678 | 0 |
| 42679 | 0 |
| 42680 | 0 |
| 42681 | 0 |
| 42682 | 0 |
| 42683 | 0 |
| 42684 | 1 |
| 42685 | 0 |
| 42686 | 0 |
| 42687 | 0 |
| 42688 | 0 |
| 42689 | 0 |
| 42690 | 1023 |
| 42691 | 1023 |
| 42692 | 1023 |
| 42693 | 1023 |
| 42694 | 1023 |
| 42695 | 1023 |
| 42696 | 1023 |
| 42697 | 1023 |
| 42698 | 1023 |
| 42699 | 1023 |
| 42700 | 1023 |
| 42701 | 1023 |
| 42702 | 1023 |
| 42703 | 1023 |
| 42704 | 1023 |
| 42705 | 1023 |
| 42706 | 1023 |
| 42707 | 1023 |
| 42708 | 1023 |
| 42709 | 1023 |
| 42710 | 1023 |
| 42711 | 1023 |
| 42712 | 1023 |
| 42713 | 1023 |
| 42714 | 1023 |
| 42715 | 1023 |
| 42716 | 1023 |
| 42717 | 1023 |
| 42718 | 1023 |
| 42719 | 1023 |
| 42720 | 1023 |
| 42721 | 1023 |
| 42722 | 1023 |
| 42723 | 1023 |
| 42724 | 1023 |
| 42725 | 1023 |
| 42726 | 1023 |
| 42727 | 1023 |
| 42728 | 0 |
| 42729 | 0 |
| 42730 | 0 |
| 42731 | 0 |
| 42732 | 0 |
| 42733 | 0 |
| 42734 | 1 |
| 42735 | 0 |
| 42736 | 0 |
| 42737 | 0 |
| 42738 | 0 |
| 42739 | 0 |
| 42740 | 0 |
| 42741 | 1023 |
| 42742 | 1023 |
| 42743 | 1023 |
| 42744 | 1023 |
| 42745 | 1023 |
| 42746 | 1023 |
| 42747 | 1023 |
| 42748 | 1023 |
| 42749 | 1023 |
| 42750 | 1023 |
| 42751 | 1023 |
| 42752 | 1023 |
| 42753 | 1023 |
| 42754 | 1023 |
| 42755 | 1023 |
| 42756 | 1023 |
| 42757 | 1023 |
| 42758 | 1023 |
| 42759 | 1023 |
| 42760 | 1023 |
| 42761 | 1023 |
| 42762 | 1023 |
| 42763 | 1023 |
| 42764 | 1023 |
| 42765 | 1023 |
| 42766 | 1023 |
| 42767 | 1023 |
| 42768 | 1023 |
| 42769 | 1023 |
| 42770 | 1023 |
| 42771 | 1023 |
| 42772 | 1023 |
| 42773 | 1023 |
| 42774 | 1023 |
| 42775 | 1023 |
| 42776 | 1023 |
| 42777 | 1023 |
| 42778 | 1023 |
| 42779 | 0 |
| 42780 | 0 |
| 42781 | 0 |
| 42782 | 0 |
| 42783 | 0 |
| 42784 | 0 |
| 42785 | 0 |
| 42786 | 0 |
| 42787 | 0 |
| 42788 | 0 |
| 42789 | 0 |
| 42790 | 0 |
| 42791 | 0 |
| 42792 | 1023 |
| 42793 | 1023 |
| 42794 | 1023 |
| 42795 | 1023 |
| 42796 | 1023 |
| 42797 | 1023 |
| 42798 | 1023 |
| 42799 | 1023 |
| 42800 | 1023 |
| 42801 | 1023 |
| 42802 | 1023 |
| 42803 | 1023 |
| 42804 | 1023 |
| 42805 | 1023 |
| 42806 | 1023 |
| 42807 | 1023 |
| 42808 | 1023 |
| 42809 | 1023 |
| 42810 | 1023 |
| 42811 | 1023 |
| 42812 | 1023 |
| 42813 | 1023 |
| 42814 | 1023 |
| 42815 | 1023 |
| 42816 | 1023 |
| 42817 | 1023 |
| 42818 | 1023 |
| 42819 | 1023 |
| 42820 | 1023 |
| 42821 | 1023 |
| 42822 | 1023 |
| 42823 | 1023 |
| 42824 | 1023 |
| 42825 | 1023 |
| 42826 | 1023 |
| 42827 | 1023 |
| 42828 | 1023 |
| 42829 | 1023 |
| 42830 | 0 |
| 42831 | 0 |
| 42832 | 0 |
| 42833 | 0 |
| 42834 | 0 |
| 42835 | 0 |
| 42836 | 0 |
| 42837 | 0 |
| 42838 | 0 |
| 42839 | 0 |
| 42840 | 0 |
| 42841 | 0 |
| 42842 | 1 |
| 42843 | 1023 |
| 42844 | 1023 |
| 42845 | 1023 |
| 42846 | 1023 |
| 42847 | 1023 |
| 42848 | 1023 |
| 42849 | 1023 |
| 42850 | 1023 |
| 42851 | 1023 |
| 42852 | 1023 |
| 42853 | 1023 |
| 42854 | 1023 |
| 42855 | 1023 |
| 42856 | 1023 |
| 42857 | 1023 |
| 42858 | 1023 |
| 42859 | 1023 |
| 42860 | 1023 |
| 42861 | 1023 |
| 42862 | 1023 |
| 42863 | 1023 |
| 42864 | 1023 |
| 42865 | 1023 |
| 42866 | 1023 |
| 42867 | 1023 |
| 42868 | 1023 |
| 42869 | 1023 |
| 42870 | 1023 |
| 42871 | 1023 |
| 42872 | 1023 |
| 42873 | 1023 |
| 42874 | 1023 |
| 42875 | 1023 |
| 42876 | 1023 |
| 42877 | 1023 |
| 42878 | 1023 |
| 42879 | 1023 |
| 42880 | 1023 |
| 42881 | 0 |
| 42882 | 0 |
| 42883 | 0 |
| 42884 | 0 |
| 42885 | 0 |
| 42886 | 0 |
| 42887 | 0 |
| 42888 | 0 |
| 42889 | 0 |
| 42890 | 0 |
| 42891 | 0 |
| 42892 | 0 |
| 42893 | 0 |
| 42894 | 1023 |
| 42895 | 1023 |
| 42896 | 1023 |
| 42897 | 1023 |
| 42898 | 1023 |
| 42899 | 1023 |
| 42900 | 1023 |
| 42901 | 1023 |
| 42902 | 1023 |
| 42903 | 1023 |
| 42904 | 1023 |
| 42905 | 1023 |
| 42906 | 1023 |
| 42907 | 1023 |
| 42908 | 1023 |
| 42909 | 1023 |
| 42910 | 1023 |
| 42911 | 1023 |
| 42912 | 1023 |
| 42913 | 1023 |
| 42914 | 1023 |
| 42915 | 1023 |
| 42916 | 1023 |
| 42917 | 1023 |
| 42918 | 1023 |
| 42919 | 1023 |
| 42920 | 1023 |
| 42921 | 1023 |
| 42922 | 1023 |
| 42923 | 1023 |
| 42924 | 1023 |
| 42925 | 1023 |
| 42926 | 1023 |
| 42927 | 1023 |
| 42928 | 1023 |
| 42929 | 1023 |
| 42930 | 1023 |
| 42931 | 1023 |
| 42932 | 0 |
| 42933 | 0 |
| 42934 | 0 |
| 42935 | 0 |
| 42936 | 0 |
| 42937 | 0 |
| 42938 | 0 |
| 42939 | 0 |
| 42940 | 0 |
| 42941 | 0 |
| 42942 | 0 |
| 42943 | 0 |
| 42944 | 0 |
| 42945 | 1023 |
| 42946 | 1023 |
| 42947 | 1023 |
| 42948 | 1023 |
| 42949 | 1023 |
| 42950 | 1023 |
| 42951 | 1023 |
| 42952 | 1023 |
| 42953 | 1023 |
| 42954 | 1023 |
| 42955 | 1023 |
| 42956 | 1023 |
| 42957 | 1023 |
| 42958 | 1023 |
| 42959 | 1023 |
| 42960 | 1023 |
| 42961 | 1023 |
| 42962 | 1023 |
| 42963 | 1023 |
| 42964 | 1023 |
| 42965 | 1023 |
| 42966 | 1023 |
| 42967 | 1023 |
| 42968 | 1023 |
| 42969 | 1023 |
| 42970 | 1023 |
| 42971 | 1023 |
| 42972 | 1023 |
| 42973 | 1023 |
| 42974 | 1023 |
| 42975 | 1023 |
| 42976 | 1023 |
| 42977 | 1023 |
| 42978 | 1023 |
| 42979 | 1023 |
| 42980 | 1023 |
| 42981 | 1023 |
| 42982 | 1023 |
| 42983 | 0 |
| 42984 | 0 |
| 42985 | 0 |
| 42986 | 0 |
| 42987 | 0 |
| 42988 | 0 |
| 42989 | 0 |
| 42990 | 0 |
| 42991 | 0 |
| 42992 | 0 |
| 42993 | 0 |
| 42994 | 0 |
| 42995 | 0 |
| 42996 | 0 |
| 42997 | 1023 |
| 42998 | 1023 |
| 42999 | 1023 |
| 43000 | 1023 |
| 43001 | 1023 |
| 43002 | 1023 |
| 43003 | 1023 |
| 43004 | 1023 |
| 43005 | 1023 |
| 43006 | 1023 |
| 43007 | 1023 |
| 43008 | 1023 |
| 43009 | 1023 |
| 43010 | 1023 |
| 43011 | 1023 |
| 43012 | 1023 |
| 43013 | 1023 |
| 43014 | 1023 |
| 43015 | 1023 |
| 43016 | 1023 |
| 43017 | 1023 |
| 43018 | 1023 |
| 43019 | 1023 |
| 43020 | 1023 |
| 43021 | 1023 |
| 43022 | 1023 |
| 43023 | 1023 |
| 43024 | 1023 |
| 43025 | 1023 |
| 43026 | 1023 |
| 43027 | 1023 |
| 43028 | 1023 |
| 43029 | 1023 |
| 43030 | 1023 |
| 43031 | 1023 |
| 43032 | 1023 |
| 43033 | 1023 |
| 43034 | 0 |
| 43035 | 0 |
| 43036 | 0 |
| 43037 | 0 |
| 43038 | 0 |
| 43039 | 0 |
| 43040 | 0 |
| 43041 | 0 |
| 43042 | 0 |
| 43043 | 0 |
| 43044 | 0 |
| 43045 | 0 |
| 43046 | 0 |
| 43047 | 0 |
| 43048 | 1023 |
| 43049 | 1023 |
| 43050 | 1023 |
| 43051 | 1023 |
| 43052 | 1023 |
| 43053 | 1023 |
| 43054 | 1023 |
| 43055 | 1023 |
| 43056 | 1023 |
| 43057 | 1023 |
| 43058 | 1023 |
| 43059 | 1023 |
| 43060 | 1023 |
| 43061 | 1023 |
| 43062 | 1023 |
| 43063 | 1023 |
| 43064 | 1023 |
| 43065 | 1023 |
| 43066 | 1023 |
| 43067 | 1023 |
| 43068 | 1023 |
| 43069 | 1023 |
| 43070 | 1023 |
| 43071 | 1023 |
| 43072 | 1023 |
| 43073 | 1023 |
| 43074 | 1023 |
| 43075 | 1023 |
| 43076 | 1023 |
| 43077 | 1023 |
| 43078 | 1023 |
| 43079 | 1023 |
| 43080 | 1023 |
| 43081 | 1023 |
| 43082 | 1023 |
| 43083 | 1023 |
| 43084 | 1023 |
| 43085 | 1023 |
| 43086 | 0 |
| 43087 | 0 |
| 43088 | 0 |
| 43089 | 0 |
| 43090 | 0 |
| 43091 | 0 |
| 43092 | 0 |
| 43093 | 0 |
| 43094 | 0 |
| 43095 | 0 |
| 43096 | 0 |
| 43097 | 0 |
| 43098 | 0 |
| 43099 | 0 |
| 43100 | 1023 |
| 43101 | 1023 |
| 43102 | 1023 |
| 43103 | 1023 |
| 43104 | 1023 |
| 43105 | 1023 |
| 43106 | 1023 |
| 43107 | 1023 |
| 43108 | 1023 |
| 43109 | 1023 |
| 43110 | 1023 |
| 43111 | 1023 |
| 43112 | 1023 |
| 43113 | 1023 |
| 43114 | 1023 |
| 43115 | 1023 |
| 43116 | 1023 |
| 43117 | 1023 |
| 43118 | 1023 |
| 43119 | 1023 |
| 43120 | 1023 |
| 43121 | 1023 |
| 43122 | 1023 |
| 43123 | 1023 |
| 43124 | 1023 |
| 43125 | 1023 |
| 43126 | 1023 |
| 43127 | 1023 |
| 43128 | 1023 |
| 43129 | 1023 |
| 43130 | 1023 |
| 43131 | 1023 |
| 43132 | 1023 |
| 43133 | 1023 |
| 43134 | 1023 |
| 43135 | 1023 |
| 43136 | 1023 |
| 43137 | 0 |
| 43138 | 0 |
| 43139 | 0 |
| 43140 | 0 |
| 43141 | 0 |
| 43142 | 0 |
| 43143 | 0 |
| 43144 | 0 |
| 43145 | 0 |
| 43146 | 0 |
| 43147 | 0 |
| 43148 | 0 |
| 43149 | 0 |
| 43150 | 0 |
| 43151 | 0 |
| 43152 | 1023 |
| 43153 | 1023 |
| 43154 | 1023 |
| 43155 | 1023 |
| 43156 | 1023 |
| 43157 | 1023 |
| 43158 | 1023 |
| 43159 | 1023 |
| 43160 | 1023 |
| 43161 | 1023 |
| 43162 | 1023 |
| 43163 | 1023 |
| 43164 | 1023 |
| 43165 | 1023 |
| 43166 | 1023 |
| 43167 | 1023 |
| 43168 | 1023 |
| 43169 | 1023 |
| 43170 | 1023 |
| 43171 | 1023 |
| 43172 | 1023 |
| 43173 | 1023 |
| 43174 | 1023 |
| 43175 | 1023 |
| 43176 | 1023 |
| 43177 | 1023 |
| 43178 | 1023 |
| 43179 | 1023 |
| 43180 | 1023 |
| 43181 | 1023 |
| 43182 | 1023 |
| 43183 | 1023 |
| 43184 | 1023 |
| 43185 | 1023 |
| 43186 | 1023 |
| 43187 | 1023 |
| 43188 | 1023 |
| 43189 | 0 |
| 43190 | 0 |
| 43191 | 0 |
| 43192 | 0 |
| 43193 | 0 |
| 43194 | 0 |
| 43195 | 0 |
| 43196 | 0 |
| 43197 | 0 |
| 43198 | 0 |
| 43199 | 0 |
| 43200 | 0 |
| 43201 | 0 |
| 43202 | 0 |
| 43203 | 0 |
| 43204 | 1023 |
| 43205 | 1023 |
| 43206 | 1023 |
| 43207 | 1023 |
| 43208 | 1023 |
| 43209 | 1023 |
| 43210 | 1023 |
| 43211 | 1023 |
| 43212 | 1023 |
| 43213 | 1023 |
| 43214 | 1023 |
| 43215 | 1023 |
| 43216 | 1023 |
| 43217 | 1023 |
| 43218 | 1023 |
| 43219 | 1023 |
| 43220 | 1023 |
| 43221 | 1023 |
| 43222 | 1023 |
| 43223 | 1023 |
| 43224 | 1023 |
| 43225 | 1023 |
| 43226 | 1023 |
| 43227 | 1023 |
| 43228 | 1023 |
| 43229 | 1023 |
| 43230 | 1023 |
| 43231 | 1023 |
| 43232 | 1023 |
| 43233 | 1023 |
| 43234 | 1023 |
| 43235 | 1023 |
| 43236 | 1023 |
| 43237 | 1023 |
| 43238 | 1023 |
| 43239 | 1023 |
| 43240 | 1023 |
| 43241 | 0 |
| 43242 | 0 |
| 43243 | 0 |
| 43244 | 0 |
| 43245 | 0 |
| 43246 | 0 |
| 43247 | 0 |
| 43248 | 0 |
| 43249 | 0 |
| 43250 | 0 |
| 43251 | 0 |
| 43252 | 0 |
| 43253 | 0 |
| 43254 | 0 |
| 43255 | 0 |
| 43256 | 1023 |
| 43257 | 1023 |
| 43258 | 1023 |
| 43259 | 1023 |
| 43260 | 1023 |
| 43261 | 1023 |
| 43262 | 1023 |
| 43263 | 1023 |
| 43264 | 1023 |
| 43265 | 1023 |
| 43266 | 1023 |
| 43267 | 1023 |
| 43268 | 1023 |
| 43269 | 1023 |
| 43270 | 1023 |
| 43271 | 1023 |
| 43272 | 1023 |
| 43273 | 1023 |
| 43274 | 1023 |
| 43275 | 1023 |
| 43276 | 1023 |
| 43277 | 1023 |
| 43278 | 1023 |
| 43279 | 1023 |
| 43280 | 1023 |
| 43281 | 1023 |
| 43282 | 1023 |
| 43283 | 1023 |
| 43284 | 1023 |
| 43285 | 1023 |
| 43286 | 1023 |
| 43287 | 1023 |
| 43288 | 1023 |
| 43289 | 1023 |
| 43290 | 1023 |
| 43291 | 1023 |
| 43292 | 1023 |
| 43293 | 0 |
| 43294 | 0 |
| 43295 | 0 |
| 43296 | 0 |
| 43297 | 0 |
| 43298 | 0 |
| 43299 | 0 |
| 43300 | 0 |
| 43301 | 0 |
| 43302 | 0 |
| 43303 | 0 |
| 43304 | 0 |
| 43305 | 0 |
| 43306 | 0 |
| 43307 | 0 |
| 43308 | 1023 |
| 43309 | 1023 |
| 43310 | 1023 |
| 43311 | 1023 |
| 43312 | 1023 |
| 43313 | 1023 |
| 43314 | 1023 |
| 43315 | 1023 |
| 43316 | 1023 |
| 43317 | 1023 |
| 43318 | 1023 |
| 43319 | 1023 |
| 43320 | 1023 |
| 43321 | 1023 |
| 43322 | 1023 |
| 43323 | 1023 |
| 43324 | 1023 |
| 43325 | 1023 |
| 43326 | 1023 |
| 43327 | 1023 |
| 43328 | 1023 |
| 43329 | 1023 |
| 43330 | 1023 |
| 43331 | 1023 |
| 43332 | 1023 |
| 43333 | 1023 |
| 43334 | 1023 |
| 43335 | 1023 |
| 43336 | 1023 |
| 43337 | 1023 |
| 43338 | 1023 |
| 43339 | 1023 |
| 43340 | 1023 |
| 43341 | 1023 |
| 43342 | 1023 |
| 43343 | 1023 |
| 43344 | 1023 |
| 43345 | 1023 |
| 43346 | 0 |
| 43347 | 0 |
| 43348 | 0 |
| 43349 | 0 |
| 43350 | 0 |
| 43351 | 0 |
| 43352 | 0 |
| 43353 | 0 |
| 43354 | 0 |
| 43355 | 0 |
| 43356 | 0 |
| 43357 | 0 |
| 43358 | 0 |
| 43359 | 1023 |
| 43360 | 1023 |
| 43361 | 1023 |
| 43362 | 1023 |
| 43363 | 1023 |
| 43364 | 1023 |
| 43365 | 1023 |
| 43366 | 1023 |
| 43367 | 1023 |
| 43368 | 1023 |
| 43369 | 1023 |
| 43370 | 1023 |
| 43371 | 1023 |
| 43372 | 1023 |
| 43373 | 1023 |
| 43374 | 1023 |
| 43375 | 1023 |
| 43376 | 1023 |
| 43377 | 1023 |
| 43378 | 1023 |
| 43379 | 1023 |
| 43380 | 1023 |
| 43381 | 1023 |
| 43382 | 1023 |
| 43383 | 1023 |
| 43384 | 1023 |
| 43385 | 1023 |
| 43386 | 1023 |
| 43387 | 1023 |
| 43388 | 1023 |
| 43389 | 1023 |
| 43390 | 1023 |
| 43391 | 1023 |
| 43392 | 1023 |
| 43393 | 1023 |
| 43394 | 1023 |
| 43395 | 1023 |
| 43396 | 1023 |
| 43397 | 0 |
| 43398 | 0 |
| 43399 | 0 |
| 43400 | 0 |
| 43401 | 0 |
| 43402 | 0 |
| 43403 | 0 |
| 43404 | 0 |
| 43405 | 0 |
| 43406 | 0 |
| 43407 | 0 |
| 43408 | 0 |
| 43409 | 0 |
| 43410 | 1023 |
| 43411 | 1023 |
| 43412 | 1023 |
| 43413 | 1023 |
| 43414 | 1023 |
| 43415 | 1023 |
| 43416 | 1023 |
| 43417 | 1023 |
| 43418 | 1023 |
| 43419 | 1023 |
| 43420 | 1023 |
| 43421 | 1023 |
| 43422 | 1023 |
| 43423 | 1023 |
| 43424 | 1023 |
| 43425 | 1023 |
| 43426 | 1023 |
| 43427 | 1023 |
| 43428 | 1023 |
| 43429 | 1023 |
| 43430 | 1023 |
| 43431 | 1023 |
| 43432 | 1023 |
| 43433 | 1023 |
| 43434 | 1023 |
| 43435 | 1023 |
| 43436 | 1023 |
| 43437 | 1023 |
| 43438 | 1023 |
| 43439 | 1023 |
| 43440 | 1023 |
| 43441 | 1023 |
| 43442 | 1023 |
| 43443 | 1023 |
| 43444 | 1023 |
| 43445 | 1023 |
| 43446 | 1023 |
| 43447 | 1023 |
| 43448 | 0 |
| 43449 | 0 |
| 43450 | 0 |
| 43451 | 0 |
| 43452 | 0 |
| 43453 | 0 |
| 43454 | 0 |
| 43455 | 0 |
| 43456 | 0 |
| 43457 | 0 |
| 43458 | 0 |
| 43459 | 0 |
| 43460 | 0 |
| 43461 | 1023 |
| 43462 | 1023 |
| 43463 | 1023 |
| 43464 | 1023 |
| 43465 | 1023 |
| 43466 | 1023 |
| 43467 | 1023 |
| 43468 | 1023 |
| 43469 | 1023 |
| 43470 | 1023 |
| 43471 | 1023 |
| 43472 | 1023 |
| 43473 | 1023 |
| 43474 | 1023 |
| 43475 | 1023 |
| 43476 | 1023 |
| 43477 | 1023 |
| 43478 | 1023 |
| 43479 | 1023 |
| 43480 | 1023 |
| 43481 | 1023 |
| 43482 | 1023 |
| 43483 | 1023 |
| 43484 | 1023 |
| 43485 | 1023 |
| 43486 | 1023 |
| 43487 | 1023 |
| 43488 | 1023 |
| 43489 | 1023 |
| 43490 | 1023 |
| 43491 | 1023 |
| 43492 | 1023 |
| 43493 | 1023 |
| 43494 | 1023 |
| 43495 | 1023 |
| 43496 | 1023 |
| 43497 | 1023 |
| 43498 | 1023 |
| 43499 | 0 |
| 43500 | 0 |
| 43501 | 0 |
| 43502 | 0 |
| 43503 | 0 |
| 43504 | 0 |
| 43505 | 0 |
| 43506 | 0 |
| 43507 | 0 |
| 43508 | 0 |
| 43509 | 0 |
| 43510 | 0 |
| 43511 | 0 |
| 43512 | 1023 |
| 43513 | 1023 |
| 43514 | 1023 |
| 43515 | 1023 |
| 43516 | 1023 |
| 43517 | 1023 |
| 43518 | 1023 |
| 43519 | 1023 |
| 43520 | 1023 |
| 43521 | 1023 |
| 43522 | 1023 |
| 43523 | 1023 |
| 43524 | 1023 |
| 43525 | 1023 |
| 43526 | 1023 |
| 43527 | 1023 |
| 43528 | 1023 |
| 43529 | 1023 |
| 43530 | 1023 |
| 43531 | 1023 |
| 43532 | 1023 |
| 43533 | 1023 |
| 43534 | 1023 |
| 43535 | 1023 |
| 43536 | 1023 |
| 43537 | 1023 |
| 43538 | 1023 |
| 43539 | 1023 |
| 43540 | 1023 |
| 43541 | 1023 |
| 43542 | 1023 |
| 43543 | 1023 |
| 43544 | 1023 |
| 43545 | 1023 |
| 43546 | 1023 |
| 43547 | 1023 |
| 43548 | 1023 |
| 43549 | 1023 |
| 43550 | 0 |
| 43551 | 0 |
| 43552 | 0 |
| 43553 | 0 |
| 43554 | 0 |
| 43555 | 0 |
| 43556 | 0 |
| 43557 | 0 |
| 43558 | 0 |
| 43559 | 0 |
| 43560 | 0 |
| 43561 | 1 |
| 43562 | 0 |
| 43563 | 0 |
| 43564 | 1023 |
| 43565 | 1023 |
| 43566 | 1023 |
| 43567 | 1023 |
| 43568 | 1023 |
| 43569 | 1023 |
| 43570 | 1023 |
| 43571 | 1023 |
| 43572 | 1023 |
| 43573 | 1023 |
| 43574 | 1023 |
| 43575 | 1023 |
| 43576 | 1023 |
| 43577 | 1023 |
| 43578 | 1023 |
| 43579 | 1023 |
| 43580 | 1023 |
| 43581 | 1023 |
| 43582 | 1023 |
| 43583 | 1023 |
| 43584 | 1023 |
| 43585 | 1023 |
| 43586 | 1023 |
| 43587 | 1023 |
| 43588 | 1023 |
| 43589 | 1023 |
| 43590 | 1023 |
| 43591 | 1023 |
| 43592 | 1023 |
| 43593 | 1023 |
| 43594 | 1023 |
| 43595 | 1023 |
| 43596 | 1023 |
| 43597 | 1023 |
| 43598 | 1023 |
| 43599 | 1023 |
| 43600 | 1023 |
| 43601 | 0 |
| 43602 | 0 |
| 43603 | 0 |
| 43604 | 0 |
| 43605 | 0 |
| 43606 | 0 |
| 43607 | 0 |
| 43608 | 0 |
| 43609 | 0 |
| 43610 | 0 |
| 43611 | 0 |
| 43612 | 0 |
| 43613 | 0 |
| 43614 | 0 |
| 43615 | 1023 |
| 43616 | 1023 |
| 43617 | 1023 |
| 43618 | 1023 |
| 43619 | 1023 |
| 43620 | 1023 |
| 43621 | 1023 |
| 43622 | 1023 |
| 43623 | 1023 |
| 43624 | 1023 |
| 43625 | 1023 |
| 43626 | 1023 |
| 43627 | 1023 |
| 43628 | 1023 |
| 43629 | 1023 |
| 43630 | 1023 |
| 43631 | 1023 |
| 43632 | 1023 |
| 43633 | 1023 |
| 43634 | 1023 |
| 43635 | 1023 |
| 43636 | 1023 |
| 43637 | 1023 |
| 43638 | 1023 |
| 43639 | 1023 |
| 43640 | 1023 |
| 43641 | 1023 |
| 43642 | 1023 |
| 43643 | 1023 |
| 43644 | 1023 |
| 43645 | 1023 |
| 43646 | 1023 |
| 43647 | 1023 |
| 43648 | 1023 |
| 43649 | 1023 |
| 43650 | 1023 |
| 43651 | 1023 |
| 43652 | 1023 |
| 43653 | 0 |
| 43654 | 0 |
| 43655 | 0 |
| 43656 | 0 |
| 43657 | 0 |
| 43658 | 0 |
| 43659 | 0 |
| 43660 | 0 |
| 43661 | 0 |
| 43662 | 0 |
| 43663 | 0 |
| 43664 | 0 |
| 43665 | 0 |
| 43666 | 1023 |
| 43667 | 1023 |
| 43668 | 1023 |
| 43669 | 1023 |
| 43670 | 1023 |
| 43671 | 1023 |
| 43672 | 1023 |
| 43673 | 1023 |
| 43674 | 1023 |
| 43675 | 1023 |
| 43676 | 1023 |
| 43677 | 1023 |
| 43678 | 1023 |
| 43679 | 1023 |
| 43680 | 1023 |
| 43681 | 1023 |
| 43682 | 1023 |
| 43683 | 1023 |
| 43684 | 1023 |
| 43685 | 1023 |
| 43686 | 1023 |
| 43687 | 1023 |
| 43688 | 1023 |
| 43689 | 1023 |
| 43690 | 1023 |
| 43691 | 1023 |
| 43692 | 1023 |
| 43693 | 1023 |
| 43694 | 1023 |
| 43695 | 1023 |
| 43696 | 1023 |
| 43697 | 1023 |
| 43698 | 1023 |
| 43699 | 1023 |
| 43700 | 1023 |
| 43701 | 1023 |
| 43702 | 1023 |
| 43703 | 1023 |
| 43704 | 0 |
| 43705 | 0 |
| 43706 | 0 |
| 43707 | 0 |
| 43708 | 0 |
| 43709 | 0 |
| 43710 | 0 |
| 43711 | 0 |
| 43712 | 0 |
| 43713 | 0 |
| 43714 | 0 |
| 43715 | 0 |
| 43716 | 0 |
| 43717 | 0 |
| 43718 | 1023 |
| 43719 | 1023 |
| 43720 | 1023 |
| 43721 | 1023 |
| 43722 | 1023 |
| 43723 | 1023 |
| 43724 | 1023 |
| 43725 | 1023 |
| 43726 | 1023 |
| 43727 | 1023 |
| 43728 | 1023 |
| 43729 | 1023 |
| 43730 | 1023 |
| 43731 | 1023 |
| 43732 | 1023 |
| 43733 | 1023 |
| 43734 | 1023 |
| 43735 | 1023 |
| 43736 | 1023 |
| 43737 | 1023 |
| 43738 | 1023 |
| 43739 | 1023 |
| 43740 | 1023 |
| 43741 | 1023 |
| 43742 | 1023 |
| 43743 | 1023 |
| 43744 | 1023 |
| 43745 | 1023 |
| 43746 | 1023 |
| 43747 | 1023 |
| 43748 | 1023 |
| 43749 | 1023 |
| 43750 | 1023 |
| 43751 | 1023 |
| 43752 | 1023 |
| 43753 | 1023 |
| 43754 | 1023 |
| 43755 | 0 |
| 43756 | 0 |
| 43757 | 0 |
| 43758 | 0 |
| 43759 | 0 |
| 43760 | 0 |
| 43761 | 0 |
| 43762 | 0 |
| 43763 | 0 |
| 43764 | 0 |
| 43765 | 0 |
| 43766 | 0 |
| 43767 | 0 |
| 43768 | 0 |
| 43769 | 0 |
| 43770 | 1023 |
| 43771 | 1023 |
| 43772 | 1023 |
| 43773 | 1023 |
| 43774 | 1023 |
| 43775 | 1023 |
| 43776 | 1023 |
| 43777 | 1023 |
| 43778 | 1023 |
| 43779 | 1023 |
| 43780 | 1023 |
| 43781 | 1023 |
| 43782 | 1023 |
| 43783 | 1023 |
| 43784 | 1023 |
| 43785 | 1023 |
| 43786 | 1023 |
| 43787 | 1023 |
| 43788 | 1023 |
| 43789 | 1023 |
| 43790 | 1023 |
| 43791 | 1023 |
| 43792 | 1023 |
| 43793 | 1023 |
| 43794 | 1023 |
| 43795 | 1023 |
| 43796 | 1023 |
| 43797 | 1023 |
| 43798 | 1023 |
| 43799 | 1023 |
| 43800 | 1023 |
| 43801 | 1023 |
| 43802 | 1023 |
| 43803 | 1023 |
| 43804 | 1023 |
| 43805 | 1023 |
| 43806 | 1023 |
| 43807 | 0 |
| 43808 | 0 |
| 43809 | 0 |
| 43810 | 0 |
| 43811 | 0 |
| 43812 | 0 |
| 43813 | 0 |
| 43814 | 0 |
| 43815 | 0 |
| 43816 | 0 |
| 43817 | 0 |
| 43818 | 0 |
| 43819 | 0 |
| 43820 | 0 |
| 43821 | 0 |
| 43822 | 1023 |
| 43823 | 1023 |
| 43824 | 1023 |
| 43825 | 1023 |
| 43826 | 1023 |
| 43827 | 1023 |
| 43828 | 1023 |
| 43829 | 1023 |
| 43830 | 1023 |
| 43831 | 1023 |
| 43832 | 1023 |
| 43833 | 1023 |
| 43834 | 1023 |
| 43835 | 1023 |
| 43836 | 1023 |
| 43837 | 1023 |
| 43838 | 1023 |
| 43839 | 1023 |
| 43840 | 1023 |
| 43841 | 1023 |
| 43842 | 1023 |
| 43843 | 1023 |
| 43844 | 1023 |
| 43845 | 1023 |
| 43846 | 1023 |
| 43847 | 1023 |
| 43848 | 1023 |
| 43849 | 1023 |
| 43850 | 1023 |
| 43851 | 1023 |
| 43852 | 1023 |
| 43853 | 1023 |
| 43854 | 1023 |
| 43855 | 1023 |
| 43856 | 1023 |
| 43857 | 1023 |
| 43858 | 1023 |
| 43859 | 0 |
| 43860 | 0 |
| 43861 | 0 |
| 43862 | 0 |
| 43863 | 0 |
| 43864 | 0 |
| 43865 | 0 |
| 43866 | 0 |
| 43867 | 0 |
| 43868 | 0 |
| 43869 | 0 |
| 43870 | 0 |
| 43871 | 0 |
| 43872 | 0 |
| 43873 | 0 |
| 43874 | 1023 |
| 43875 | 1023 |
| 43876 | 1023 |
| 43877 | 1023 |
| 43878 | 1023 |
| 43879 | 1023 |
| 43880 | 1023 |
| 43881 | 1023 |
| 43882 | 1023 |
| 43883 | 1023 |
| 43884 | 1023 |
| 43885 | 1023 |
| 43886 | 1023 |
| 43887 | 1023 |
| 43888 | 1023 |
| 43889 | 1023 |
| 43890 | 1023 |
| 43891 | 1023 |
| 43892 | 1023 |
| 43893 | 1023 |
| 43894 | 1023 |
| 43895 | 1023 |
| 43896 | 1023 |
| 43897 | 1023 |
| 43898 | 1023 |
| 43899 | 1023 |
| 43900 | 1023 |
| 43901 | 1023 |
| 43902 | 1023 |
| 43903 | 1023 |
| 43904 | 1023 |
| 43905 | 1023 |
| 43906 | 1023 |
| 43907 | 1023 |
| 43908 | 1023 |
| 43909 | 1023 |
| 43910 | 1023 |
| 43911 | 1023 |
| 43912 | 0 |
| 43913 | 0 |
| 43914 | 0 |
| 43915 | 0 |
| 43916 | 0 |
| 43917 | 0 |
| 43918 | 0 |
| 43919 | 0 |
| 43920 | 0 |
| 43921 | 0 |
| 43922 | 0 |
| 43923 | 0 |
| 43924 | 1 |
| 43925 | 1023 |
| 43926 | 1023 |
| 43927 | 1023 |
| 43928 | 1023 |
| 43929 | 1023 |
| 43930 | 1023 |
| 43931 | 1023 |
| 43932 | 1023 |
| 43933 | 1023 |
| 43934 | 1023 |
| 43935 | 1023 |
| 43936 | 1023 |
| 43937 | 1023 |
| 43938 | 1023 |
| 43939 | 1023 |
| 43940 | 1023 |
| 43941 | 1023 |
| 43942 | 1023 |
| 43943 | 1023 |
| 43944 | 1023 |
| 43945 | 1023 |
| 43946 | 1023 |
| 43947 | 1023 |
| 43948 | 1023 |
| 43949 | 1023 |
| 43950 | 1023 |
| 43951 | 1023 |
| 43952 | 1023 |
| 43953 | 1023 |
| 43954 | 1023 |
| 43955 | 1023 |
| 43956 | 1023 |
| 43957 | 1023 |
| 43958 | 1023 |
| 43959 | 1023 |
| 43960 | 1023 |
| 43961 | 1023 |
| 43962 | 1023 |
| 43963 | 0 |
| 43964 | 0 |
| 43965 | 0 |
| 43966 | 0 |
| 43967 | 0 |
| 43968 | 0 |
| 43969 | 0 |
| 43970 | 0 |
| 43971 | 0 |
| 43972 | 0 |
| 43973 | 0 |
| 43974 | 0 |
| 43975 | 0 |
| 43976 | 1023 |
| 43977 | 1023 |
| 43978 | 1023 |
| 43979 | 1023 |
| 43980 | 1023 |
| 43981 | 1023 |
| 43982 | 1023 |
| 43983 | 1023 |
| 43984 | 1023 |
| 43985 | 1023 |
| 43986 | 1023 |
| 43987 | 1023 |
| 43988 | 1023 |
| 43989 | 1023 |
| 43990 | 1023 |
| 43991 | 1023 |
| 43992 | 1023 |
| 43993 | 1023 |
| 43994 | 1023 |
| 43995 | 1023 |
| 43996 | 1023 |
| 43997 | 1023 |
| 43998 | 1023 |
| 43999 | 1023 |
| 44000 | 1023 |
| 44001 | 1023 |
| 44002 | 1023 |
| 44003 | 1023 |
| 44004 | 1023 |
| 44005 | 1023 |
| 44006 | 1023 |
| 44007 | 1023 |
| 44008 | 1023 |
| 44009 | 1023 |
| 44010 | 1023 |
| 44011 | 1023 |
| 44012 | 1023 |
| 44013 | 1023 |
| 44014 | 0 |
| 44015 | 0 |
| 44016 | 0 |
| 44017 | 0 |
| 44018 | 0 |
| 44019 | 0 |
| 44020 | 0 |
| 44021 | 0 |
| 44022 | 0 |
| 44023 | 0 |
| 44024 | 0 |
| 44025 | 0 |
| 44026 | 0 |
| 44027 | 1023 |
| 44028 | 1023 |
| 44029 | 1023 |
| 44030 | 1023 |
| 44031 | 1023 |
| 44032 | 1023 |
| 44033 | 1023 |
| 44034 | 1023 |
| 44035 | 1023 |
| 44036 | 1023 |
| 44037 | 1023 |
| 44038 | 1023 |
| 44039 | 1023 |
| 44040 | 1023 |
| 44041 | 1023 |
| 44042 | 1023 |
| 44043 | 1023 |
| 44044 | 1023 |
| 44045 | 1023 |
| 44046 | 1023 |
| 44047 | 1023 |
| 44048 | 1023 |
| 44049 | 1023 |
| 44050 | 1023 |
| 44051 | 1023 |
| 44052 | 1023 |
| 44053 | 1023 |
| 44054 | 1023 |
| 44055 | 1023 |
| 44056 | 1023 |
| 44057 | 1023 |
| 44058 | 1023 |
| 44059 | 1023 |
| 44060 | 1023 |
| 44061 | 1023 |
| 44062 | 1023 |
| 44063 | 1023 |
| 44064 | 1023 |
| 44065 | 0 |
| 44066 | 0 |
| 44067 | 0 |
| 44068 | 0 |
| 44069 | 0 |
| 44070 | 0 |
| 44071 | 0 |
| 44072 | 0 |
| 44073 | 0 |
| 44074 | 0 |
| 44075 | 0 |
| 44076 | 0 |
| 44077 | 0 |
| 44078 | 1023 |
| 44079 | 1023 |
| 44080 | 1023 |
| 44081 | 1023 |
| 44082 | 1023 |
| 44083 | 1023 |
| 44084 | 1023 |
| 44085 | 1023 |
| 44086 | 1023 |
| 44087 | 1023 |
| 44088 | 1023 |
| 44089 | 1023 |
| 44090 | 1023 |
| 44091 | 1023 |
| 44092 | 1023 |
| 44093 | 1023 |
| 44094 | 1023 |
| 44095 | 1023 |
| 44096 | 1023 |
| 44097 | 1023 |
| 44098 | 1023 |
| 44099 | 1023 |
| 44100 | 1023 |
| 44101 | 1023 |
| 44102 | 1023 |
| 44103 | 1023 |
| 44104 | 1023 |
| 44105 | 1023 |
| 44106 | 1023 |
| 44107 | 1023 |
| 44108 | 1023 |
| 44109 | 1023 |
| 44110 | 1023 |
| 44111 | 1023 |
| 44112 | 1023 |
| 44113 | 1023 |
| 44114 | 1023 |
| 44115 | 1023 |
| 44116 | 0 |
| 44117 | 0 |
| 44118 | 0 |
| 44119 | 0 |
| 44120 | 0 |
| 44121 | 0 |
| 44122 | 0 |
| 44123 | 0 |
| 44124 | 0 |
| 44125 | 0 |
| 44126 | 0 |
| 44127 | 0 |
| 44128 | 0 |
| 44129 | 1023 |
| 44130 | 1023 |
| 44131 | 1023 |
| 44132 | 1023 |
| 44133 | 1023 |
| 44134 | 1023 |
| 44135 | 1023 |
| 44136 | 1023 |
| 44137 | 1023 |
| 44138 | 1023 |
| 44139 | 1023 |
| 44140 | 1023 |
| 44141 | 1023 |
| 44142 | 1023 |
| 44143 | 1023 |
| 44144 | 1023 |
| 44145 | 1023 |
| 44146 | 1023 |
| 44147 | 1023 |
| 44148 | 1023 |
| 44149 | 1023 |
| 44150 | 1023 |
| 44151 | 1023 |
| 44152 | 1023 |
| 44153 | 1023 |
| 44154 | 1023 |
| 44155 | 1023 |
| 44156 | 1023 |
| 44157 | 1023 |
| 44158 | 1023 |
| 44159 | 1023 |
| 44160 | 1023 |
| 44161 | 1023 |
| 44162 | 1023 |
| 44163 | 1023 |
| 44164 | 1023 |
| 44165 | 1023 |
| 44166 | 1023 |
| 44167 | 0 |
| 44168 | 0 |
| 44169 | 0 |
| 44170 | 0 |
| 44171 | 0 |
| 44172 | 0 |
| 44173 | 0 |
| 44174 | 0 |
| 44175 | 0 |
| 44176 | 1 |
| 44177 | 0 |
| 44178 | 0 |
| 44179 | 0 |
| 44180 | 1023 |
| 44181 | 1023 |
| 44182 | 1023 |
| 44183 | 1023 |
| 44184 | 1023 |
| 44185 | 1023 |
| 44186 | 1023 |
| 44187 | 1023 |
| 44188 | 1023 |
| 44189 | 1023 |
| 44190 | 1023 |
| 44191 | 1023 |
| 44192 | 1023 |
| 44193 | 1023 |
| 44194 | 1023 |
| 44195 | 1023 |
| 44196 | 1023 |
| 44197 | 1023 |
| 44198 | 1023 |
| 44199 | 1023 |
| 44200 | 1023 |
| 44201 | 1023 |
| 44202 | 1023 |
| 44203 | 1023 |
| 44204 | 1023 |
| 44205 | 1023 |
| 44206 | 1023 |
| 44207 | 1023 |
| 44208 | 1023 |
| 44209 | 1023 |
| 44210 | 1023 |
| 44211 | 1023 |
| 44212 | 1023 |
| 44213 | 1023 |
| 44214 | 1023 |
| 44215 | 1023 |
| 44216 | 1023 |
| 44217 | 1023 |
| 44218 | 0 |
| 44219 | 0 |
| 44220 | 0 |
| 44221 | 0 |
| 44222 | 0 |
| 44223 | 0 |
| 44224 | 0 |
| 44225 | 1 |
| 44226 | 0 |
| 44227 | 0 |
| 44228 | 0 |
| 44229 | 0 |
| 44230 | 0 |
| 44231 | 0 |
| 44232 | 1023 |
| 44233 | 1023 |
| 44234 | 1023 |
| 44235 | 1023 |
| 44236 | 1023 |
| 44237 | 1023 |
| 44238 | 1023 |
| 44239 | 1023 |
| 44240 | 1023 |
| 44241 | 1023 |
| 44242 | 1023 |
| 44243 | 1023 |
| 44244 | 1023 |
| 44245 | 1023 |
| 44246 | 1023 |
| 44247 | 1023 |
| 44248 | 1023 |
| 44249 | 1023 |
| 44250 | 1023 |
| 44251 | 1023 |
| 44252 | 1023 |
| 44253 | 1023 |
| 44254 | 1023 |
| 44255 | 1023 |
| 44256 | 1023 |
| 44257 | 1023 |
| 44258 | 1023 |
| 44259 | 1023 |
| 44260 | 1023 |
| 44261 | 1023 |
| 44262 | 1023 |
| 44263 | 1023 |
| 44264 | 1023 |
| 44265 | 1023 |
| 44266 | 1023 |
| 44267 | 1023 |
| 44268 | 1023 |
| 44269 | 0 |
| 44270 | 1 |
| 44271 | 0 |
| 44272 | 0 |
| 44273 | 0 |
| 44274 | 0 |
| 44275 | 0 |
| 44276 | 0 |
| 44277 | 0 |
| 44278 | 0 |
| 44279 | 0 |
| 44280 | 0 |
| 44281 | 0 |
| 44282 | 0 |
| 44283 | 1023 |
| 44284 | 1023 |
| 44285 | 1023 |
| 44286 | 1023 |
| 44287 | 1023 |
| 44288 | 1023 |
| 44289 | 1023 |
| 44290 | 1023 |
| 44291 | 1023 |
| 44292 | 1023 |
| 44293 | 1023 |
| 44294 | 1023 |
| 44295 | 1023 |
| 44296 | 1023 |
| 44297 | 1023 |
| 44298 | 1023 |
| 44299 | 1023 |
| 44300 | 1023 |
| 44301 | 1023 |
| 44302 | 1023 |
| 44303 | 1023 |
| 44304 | 1023 |
| 44305 | 1023 |
| 44306 | 1023 |
| 44307 | 1023 |
| 44308 | 1023 |
| 44309 | 1023 |
| 44310 | 1023 |
| 44311 | 1023 |
| 44312 | 1023 |
| 44313 | 1023 |
| 44314 | 1023 |
| 44315 | 1023 |
| 44316 | 1023 |
| 44317 | 1023 |
| 44318 | 1023 |
| 44319 | 1023 |
| 44320 | 1023 |
| 44321 | 0 |
| 44322 | 0 |
| 44323 | 0 |
| 44324 | 1 |
| 44325 | 1 |
| 44326 | 0 |
| 44327 | 0 |
| 44328 | 0 |
| 44329 | 0 |
| 44330 | 0 |
| 44331 | 0 |
| 44332 | 0 |
| 44333 | 0 |
| 44334 | 0 |
| 44335 | 1023 |
| 44336 | 1023 |
| 44337 | 1023 |
| 44338 | 1023 |
| 44339 | 1023 |
| 44340 | 1023 |
| 44341 | 1023 |
| 44342 | 1023 |
| 44343 | 1023 |
| 44344 | 1023 |
| 44345 | 1023 |
| 44346 | 1023 |
| 44347 | 1023 |
| 44348 | 1023 |
| 44349 | 1023 |
| 44350 | 1023 |
| 44351 | 1023 |
| 44352 | 1023 |
| 44353 | 1023 |
| 44354 | 1023 |
| 44355 | 1023 |
| 44356 | 1023 |
| 44357 | 1023 |
| 44358 | 1023 |
| 44359 | 1023 |
| 44360 | 1023 |
| 44361 | 1023 |
| 44362 | 1023 |
| 44363 | 1023 |
| 44364 | 1023 |
| 44365 | 1023 |
| 44366 | 1023 |
| 44367 | 1023 |
| 44368 | 1023 |
| 44369 | 1023 |
| 44370 | 1023 |
| 44371 | 1023 |
| 44372 | 0 |
| 44373 | 0 |
| 44374 | 0 |
| 44375 | 0 |
| 44376 | 0 |
| 44377 | 0 |
| 44378 | 0 |
| 44379 | 0 |
| 44380 | 0 |
| 44381 | 0 |
| 44382 | 0 |
| 44383 | 0 |
| 44384 | 0 |
| 44385 | 0 |
| 44386 | 1023 |
| 44387 | 1023 |
| 44388 | 1023 |
| 44389 | 1023 |
| 44390 | 1023 |
| 44391 | 1023 |
| 44392 | 1023 |
| 44393 | 1023 |
| 44394 | 1023 |
| 44395 | 1023 |
| 44396 | 1023 |
| 44397 | 1023 |
| 44398 | 1023 |
| 44399 | 1023 |
| 44400 | 1023 |
| 44401 | 1023 |
| 44402 | 1023 |
| 44403 | 1023 |
| 44404 | 1023 |
| 44405 | 1023 |
| 44406 | 1023 |
| 44407 | 1023 |
| 44408 | 1023 |
| 44409 | 1023 |
| 44410 | 1023 |
| 44411 | 1023 |
| 44412 | 1023 |
| 44413 | 1023 |
| 44414 | 1023 |
| 44415 | 1023 |
| 44416 | 1023 |
| 44417 | 1023 |
| 44418 | 1023 |
| 44419 | 1023 |
| 44420 | 1023 |
| 44421 | 1023 |
| 44422 | 1023 |
| 44423 | 1023 |
| 44424 | 0 |
| 44425 | 0 |
| 44426 | 0 |
| 44427 | 0 |
| 44428 | 0 |
| 44429 | 0 |
| 44430 | 0 |
| 44431 | 0 |
| 44432 | 0 |
| 44433 | 0 |
| 44434 | 0 |
| 44435 | 0 |
| 44436 | 0 |
| 44437 | 0 |
| 44438 | 1023 |
| 44439 | 1023 |
| 44440 | 1023 |
| 44441 | 1023 |
| 44442 | 1023 |
| 44443 | 1023 |
| 44444 | 1023 |
| 44445 | 1023 |
| 44446 | 1023 |
| 44447 | 1023 |
| 44448 | 1023 |
| 44449 | 1023 |
| 44450 | 1023 |
| 44451 | 1023 |
| 44452 | 1023 |
| 44453 | 1023 |
| 44454 | 1023 |
| 44455 | 1023 |
| 44456 | 1023 |
| 44457 | 1023 |
| 44458 | 1023 |
| 44459 | 1023 |
| 44460 | 1023 |
| 44461 | 1023 |
| 44462 | 1023 |
| 44463 | 1023 |
| 44464 | 1023 |
| 44465 | 1023 |
| 44466 | 1023 |
| 44467 | 1023 |
| 44468 | 1023 |
| 44469 | 1023 |
| 44470 | 1023 |
| 44471 | 1023 |
| 44472 | 1023 |
| 44473 | 1023 |
| 44474 | 1023 |
| 44475 | 1023 |
| 44476 | 0 |
| 44477 | 0 |
| 44478 | 0 |
| 44479 | 0 |
| 44480 | 0 |
| 44481 | 0 |
| 44482 | 0 |
| 44483 | 0 |
| 44484 | 0 |
| 44485 | 0 |
| 44486 | 0 |
| 44487 | 0 |
| 44488 | 0 |
| 44489 | 1023 |
| 44490 | 1023 |
| 44491 | 1023 |
| 44492 | 1023 |
| 44493 | 1023 |
| 44494 | 1023 |
| 44495 | 1023 |
| 44496 | 1023 |
| 44497 | 1023 |
| 44498 | 1023 |
| 44499 | 1023 |
| 44500 | 1023 |
| 44501 | 1023 |
| 44502 | 1023 |
| 44503 | 1023 |
| 44504 | 1023 |
| 44505 | 1023 |
| 44506 | 1023 |
| 44507 | 1023 |
| 44508 | 1023 |
| 44509 | 1023 |
| 44510 | 1023 |
| 44511 | 1023 |
| 44512 | 1023 |
| 44513 | 1023 |
| 44514 | 1023 |
| 44515 | 1023 |
| 44516 | 1023 |
| 44517 | 1023 |
| 44518 | 1023 |
| 44519 | 1023 |
| 44520 | 1023 |
| 44521 | 1023 |
| 44522 | 1023 |
| 44523 | 1023 |
| 44524 | 1023 |
| 44525 | 1023 |
| 44526 | 1023 |
| 44527 | 0 |
| 44528 | 0 |
| 44529 | 0 |
| 44530 | 0 |
| 44531 | 0 |
| 44532 | 0 |
| 44533 | 0 |
| 44534 | 0 |
| 44535 | 0 |
| 44536 | 0 |
| 44537 | 0 |
| 44538 | 0 |
| 44539 | 0 |
| 44540 | 1023 |
| 44541 | 1023 |
| 44542 | 1023 |
| 44543 | 1023 |
| 44544 | 1023 |
| 44545 | 1023 |
| 44546 | 1023 |
| 44547 | 1023 |
| 44548 | 1023 |
| 44549 | 1023 |
| 44550 | 1023 |
| 44551 | 1023 |
| 44552 | 1023 |
| 44553 | 1023 |
| 44554 | 1023 |
| 44555 | 1023 |
| 44556 | 1023 |
| 44557 | 1023 |
| 44558 | 1023 |
| 44559 | 1023 |
| 44560 | 1023 |
| 44561 | 1023 |
| 44562 | 1023 |
| 44563 | 1023 |
| 44564 | 1023 |
| 44565 | 1023 |
| 44566 | 1023 |
| 44567 | 1023 |
| 44568 | 1023 |
| 44569 | 1023 |
| 44570 | 1023 |
| 44571 | 1023 |
| 44572 | 1023 |
| 44573 | 1023 |
| 44574 | 1023 |
| 44575 | 1023 |
| 44576 | 1023 |
| 44577 | 1023 |
| 44578 | 0 |
| 44579 | 0 |
| 44580 | 0 |
| 44581 | 0 |
| 44582 | 0 |
| 44583 | 0 |
| 44584 | 0 |
| 44585 | 0 |
| 44586 | 0 |
| 44587 | 0 |
| 44588 | 0 |
| 44589 | 0 |
| 44590 | 0 |
| 44591 | 1023 |
| 44592 | 1023 |
| 44593 | 1023 |
| 44594 | 1023 |
| 44595 | 1023 |
| 44596 | 1023 |
| 44597 | 1023 |
| 44598 | 1023 |
| 44599 | 1023 |
| 44600 | 1023 |
| 44601 | 1023 |
| 44602 | 1023 |
| 44603 | 1023 |
| 44604 | 1023 |
| 44605 | 1023 |
| 44606 | 1023 |
| 44607 | 1023 |
| 44608 | 1023 |
| 44609 | 1023 |
| 44610 | 1023 |
| 44611 | 1023 |
| 44612 | 1023 |
| 44613 | 1023 |
| 44614 | 1023 |
| 44615 | 1023 |
| 44616 | 1023 |
| 44617 | 1023 |
| 44618 | 1023 |
| 44619 | 1023 |
| 44620 | 1023 |
| 44621 | 1023 |
| 44622 | 1023 |
| 44623 | 1023 |
| 44624 | 1023 |
| 44625 | 1023 |
| 44626 | 1023 |
| 44627 | 1023 |
| 44628 | 1023 |
| 44629 | 0 |
| 44630 | 0 |
| 44631 | 0 |
| 44632 | 0 |
| 44633 | 0 |
| 44634 | 0 |
| 44635 | 0 |
| 44636 | 0 |
| 44637 | 0 |
| 44638 | 0 |
| 44639 | 0 |
| 44640 | 0 |
| 44641 | 0 |
| 44642 | 1023 |
| 44643 | 1023 |
| 44644 | 1023 |
| 44645 | 1023 |
| 44646 | 1023 |
| 44647 | 1023 |
| 44648 | 1023 |
| 44649 | 1023 |
| 44650 | 1023 |
| 44651 | 1023 |
| 44652 | 1023 |
| 44653 | 1023 |
| 44654 | 1023 |
| 44655 | 1023 |
| 44656 | 1023 |
| 44657 | 1023 |
| 44658 | 1023 |
| 44659 | 1023 |
| 44660 | 1023 |
| 44661 | 1023 |
| 44662 | 1023 |
| 44663 | 1023 |
| 44664 | 1023 |
| 44665 | 1023 |
| 44666 | 1023 |
| 44667 | 1023 |
| 44668 | 1023 |
| 44669 | 1023 |
| 44670 | 1023 |
| 44671 | 1023 |
| 44672 | 1023 |
| 44673 | 1023 |
| 44674 | 1023 |
| 44675 | 1023 |
| 44676 | 1023 |
| 44677 | 1023 |
| 44678 | 1023 |
| 44679 | 1023 |
| 44680 | 0 |
| 44681 | 0 |
| 44682 | 0 |
| 44683 | 0 |
| 44684 | 0 |
| 44685 | 0 |
| 44686 | 0 |
| 44687 | 0 |
| 44688 | 0 |
| 44689 | 0 |
| 44690 | 0 |
| 44691 | 0 |
| 44692 | 0 |
| 44693 | 1023 |
| 44694 | 1023 |
| 44695 | 1023 |
| 44696 | 1023 |
| 44697 | 1023 |
| 44698 | 1023 |
| 44699 | 1023 |
| 44700 | 1023 |
| 44701 | 1023 |
| 44702 | 1023 |
| 44703 | 1023 |
| 44704 | 1023 |
| 44705 | 1023 |
| 44706 | 1023 |
| 44707 | 1023 |
| 44708 | 1023 |
| 44709 | 1023 |
| 44710 | 1023 |
| 44711 | 1023 |
| 44712 | 1023 |
| 44713 | 1023 |
| 44714 | 1023 |
| 44715 | 1023 |
| 44716 | 1023 |
| 44717 | 1023 |
| 44718 | 1023 |
| 44719 | 1023 |
| 44720 | 1023 |
| 44721 | 1023 |
| 44722 | 1023 |
| 44723 | 1023 |
| 44724 | 1023 |
| 44725 | 1023 |
| 44726 | 1023 |
| 44727 | 1023 |
| 44728 | 1023 |
| 44729 | 1023 |
| 44730 | 1023 |
| 44731 | 0 |
| 44732 | 0 |
| 44733 | 0 |
| 44734 | 0 |
| 44735 | 0 |
| 44736 | 0 |
| 44737 | 0 |
| 44738 | 0 |
| 44739 | 0 |
| 44740 | 0 |
| 44741 | 0 |
| 44742 | 0 |
| 44743 | 0 |
| 44744 | 1023 |
| 44745 | 1023 |
| 44746 | 1023 |
| 44747 | 1023 |
| 44748 | 1023 |
| 44749 | 1023 |
| 44750 | 1023 |
| 44751 | 1023 |
| 44752 | 1023 |
| 44753 | 1023 |
| 44754 | 1023 |
| 44755 | 1023 |
| 44756 | 1023 |
| 44757 | 1023 |
| 44758 | 1023 |
| 44759 | 1023 |
| 44760 | 1023 |
| 44761 | 1023 |
| 44762 | 1023 |
| 44763 | 1023 |
| 44764 | 1023 |
| 44765 | 1023 |
| 44766 | 1023 |
| 44767 | 1023 |
| 44768 | 1023 |
| 44769 | 1023 |
| 44770 | 1023 |
| 44771 | 1023 |
| 44772 | 1023 |
| 44773 | 1023 |
| 44774 | 1023 |
| 44775 | 1023 |
| 44776 | 1023 |
| 44777 | 1023 |
| 44778 | 1023 |
| 44779 | 1023 |
| 44780 | 1023 |
| 44781 | 1023 |
| 44782 | 0 |
| 44783 | 0 |
| 44784 | 0 |
| 44785 | 0 |
| 44786 | 0 |
| 44787 | 0 |
| 44788 | 0 |
| 44789 | 0 |
| 44790 | 0 |
| 44791 | 0 |
| 44792 | 0 |
| 44793 | 0 |
| 44794 | 0 |
| 44795 | 1023 |
| 44796 | 1023 |
| 44797 | 1023 |
| 44798 | 1023 |
| 44799 | 1023 |
| 44800 | 1023 |
| 44801 | 1023 |
| 44802 | 1023 |
| 44803 | 1023 |
| 44804 | 1023 |
| 44805 | 1023 |
| 44806 | 1023 |
| 44807 | 1023 |
| 44808 | 1023 |
| 44809 | 1023 |
| 44810 | 1023 |
| 44811 | 1023 |
| 44812 | 1023 |
| 44813 | 1023 |
| 44814 | 1023 |
| 44815 | 1023 |
| 44816 | 1023 |
| 44817 | 1023 |
| 44818 | 1023 |
| 44819 | 1023 |
| 44820 | 1023 |
| 44821 | 1023 |
| 44822 | 1023 |
| 44823 | 1023 |
| 44824 | 1023 |
| 44825 | 1023 |
| 44826 | 1023 |
| 44827 | 1023 |
| 44828 | 1023 |
| 44829 | 1023 |
| 44830 | 1023 |
| 44831 | 1023 |
| 44832 | 1023 |
| 44833 | 0 |
| 44834 | 0 |
| 44835 | 0 |
| 44836 | 0 |
| 44837 | 0 |
| 44838 | 0 |
| 44839 | 0 |
| 44840 | 0 |
| 44841 | 0 |
| 44842 | 0 |
| 44843 | 0 |
| 44844 | 0 |
| 44845 | 0 |
| 44846 | 1023 |
| 44847 | 1023 |
| 44848 | 1023 |
| 44849 | 1023 |
| 44850 | 1023 |
| 44851 | 1023 |
| 44852 | 1023 |
| 44853 | 1023 |
| 44854 | 1023 |
| 44855 | 1023 |
| 44856 | 1023 |
| 44857 | 1023 |
| 44858 | 1023 |
| 44859 | 1023 |
| 44860 | 1023 |
| 44861 | 1023 |
| 44862 | 1023 |
| 44863 | 1023 |
| 44864 | 1023 |
| 44865 | 1023 |
| 44866 | 1023 |
| 44867 | 1023 |
| 44868 | 1023 |
| 44869 | 1023 |
| 44870 | 1023 |
| 44871 | 1023 |
| 44872 | 1023 |
| 44873 | 1023 |
| 44874 | 1023 |
| 44875 | 1023 |
| 44876 | 1023 |
| 44877 | 1023 |
| 44878 | 1023 |
| 44879 | 1023 |
| 44880 | 1023 |
| 44881 | 1023 |
| 44882 | 1023 |
| 44883 | 1023 |
| 44884 | 0 |
| 44885 | 0 |
| 44886 | 0 |
| 44887 | 0 |
| 44888 | 0 |
| 44889 | 0 |
| 44890 | 0 |
| 44891 | 0 |
| 44892 | 0 |
| 44893 | 0 |
| 44894 | 0 |
| 44895 | 0 |
| 44896 | 0 |
| 44897 | 0 |
| 44898 | 1023 |
| 44899 | 1023 |
| 44900 | 1023 |
| 44901 | 1023 |
| 44902 | 1023 |
| 44903 | 1023 |
| 44904 | 1023 |
| 44905 | 1023 |
| 44906 | 1023 |
| 44907 | 1023 |
| 44908 | 1023 |
| 44909 | 1023 |
| 44910 | 1023 |
| 44911 | 1023 |
| 44912 | 1023 |
| 44913 | 1023 |
| 44914 | 1023 |
| 44915 | 1023 |
| 44916 | 1023 |
| 44917 | 1023 |
| 44918 | 1023 |
| 44919 | 1023 |
| 44920 | 1023 |
| 44921 | 1023 |
| 44922 | 1023 |
| 44923 | 1023 |
| 44924 | 1023 |
| 44925 | 1023 |
| 44926 | 1023 |
| 44927 | 1023 |
| 44928 | 1023 |
| 44929 | 1023 |
| 44930 | 1023 |
| 44931 | 1023 |
| 44932 | 1023 |
| 44933 | 1023 |
| 44934 | 1023 |
| 44935 | 0 |
| 44936 | 0 |
| 44937 | 0 |
| 44938 | 1 |
| 44939 | 1 |
| 44940 | 0 |
| 44941 | 0 |
| 44942 | 0 |
| 44943 | 0 |
| 44944 | 0 |
| 44945 | 0 |
| 44946 | 0 |
| 44947 | 0 |
| 44948 | 0 |
| 44949 | 0 |
| 44950 | 1023 |
| 44951 | 1023 |
| 44952 | 1023 |
| 44953 | 1023 |
| 44954 | 1023 |
| 44955 | 1023 |
| 44956 | 1023 |
| 44957 | 1023 |
| 44958 | 1023 |
| 44959 | 1023 |
| 44960 | 1023 |
| 44961 | 1023 |
| 44962 | 1023 |
| 44963 | 1023 |
| 44964 | 1023 |
| 44965 | 1023 |
| 44966 | 1023 |
| 44967 | 1023 |
| 44968 | 1023 |
| 44969 | 1023 |
| 44970 | 1023 |
| 44971 | 1023 |
| 44972 | 1023 |
| 44973 | 1023 |
| 44974 | 1023 |
| 44975 | 1023 |
| 44976 | 1023 |
| 44977 | 1023 |
| 44978 | 1023 |
| 44979 | 1023 |
| 44980 | 1023 |
| 44981 | 1023 |
| 44982 | 1023 |
| 44983 | 1023 |
| 44984 | 1023 |
| 44985 | 1023 |
| 44986 | 1023 |
| 44987 | 0 |
| 44988 | 0 |
| 44989 | 0 |
| 44990 | 0 |
| 44991 | 0 |
| 44992 | 0 |
| 44993 | 0 |
| 44994 | 0 |
| 44995 | 0 |
| 44996 | 0 |
| 44997 | 0 |
| 44998 | 0 |
| 44999 | 0 |
| 45000 | 0 |
| 45001 | 0 |
| 45002 | 1023 |
| 45003 | 1023 |
| 45004 | 1023 |
| 45005 | 1023 |
| 45006 | 1023 |
| 45007 | 1023 |
| 45008 | 1023 |
| 45009 | 1023 |
| 45010 | 1023 |
| 45011 | 1023 |
| 45012 | 1023 |
| 45013 | 1023 |
| 45014 | 1023 |
| 45015 | 1023 |
| 45016 | 1023 |
| 45017 | 1023 |
| 45018 | 1023 |
| 45019 | 1023 |
| 45020 | 1023 |
| 45021 | 1023 |
| 45022 | 1023 |
| 45023 | 1023 |
| 45024 | 1023 |
| 45025 | 1023 |
| 45026 | 1023 |
| 45027 | 1023 |
| 45028 | 1023 |
| 45029 | 1023 |
| 45030 | 1023 |
| 45031 | 1023 |
| 45032 | 1023 |
| 45033 | 1023 |
| 45034 | 1023 |
| 45035 | 1023 |
| 45036 | 1023 |
| 45037 | 1023 |
| 45038 | 1023 |
| 45039 | 0 |
| 45040 | 0 |
| 45041 | 0 |
| 45042 | 0 |
| 45043 | 0 |
| 45044 | 0 |
| 45045 | 0 |
| 45046 | 0 |
| 45047 | 0 |
| 45048 | 0 |
| 45049 | 0 |
| 45050 | 0 |
| 45051 | 0 |
| 45052 | 0 |
| 45053 | 0 |
| 45054 | 1023 |
| 45055 | 1023 |
| 45056 | 1023 |
| 45057 | 1023 |
| 45058 | 1023 |
| 45059 | 1023 |
| 45060 | 1023 |
| 45061 | 1023 |
| 45062 | 1023 |
| 45063 | 1023 |
| 45064 | 1023 |
| 45065 | 1023 |
| 45066 | 1023 |
| 45067 | 1023 |
| 45068 | 1023 |
| 45069 | 1023 |
| 45070 | 1023 |
| 45071 | 1023 |
| 45072 | 1023 |
| 45073 | 1023 |
| 45074 | 1023 |
| 45075 | 1023 |
| 45076 | 1023 |
| 45077 | 1023 |
| 45078 | 1023 |
| 45079 | 1023 |
| 45080 | 1023 |
| 45081 | 1023 |
| 45082 | 1023 |
| 45083 | 1023 |
| 45084 | 1023 |
| 45085 | 1023 |
| 45086 | 1023 |
| 45087 | 1023 |
| 45088 | 1023 |
| 45089 | 1023 |
| 45090 | 1023 |
| 45091 | 0 |
| 45092 | 0 |
| 45093 | 0 |
| 45094 | 0 |
| 45095 | 0 |
| 45096 | 0 |
| 45097 | 0 |
| 45098 | 0 |
| 45099 | 0 |
| 45100 | 0 |
| 45101 | 0 |
| 45102 | 0 |
| 45103 | 0 |
| 45104 | 0 |
| 45105 | 0 |
| 45106 | 1023 |
| 45107 | 1023 |
| 45108 | 1023 |
| 45109 | 1023 |
| 45110 | 1023 |
| 45111 | 1023 |
| 45112 | 1023 |
| 45113 | 1023 |
| 45114 | 1023 |
| 45115 | 1023 |
| 45116 | 1023 |
| 45117 | 1023 |
| 45118 | 1023 |
| 45119 | 1023 |
| 45120 | 1023 |
| 45121 | 1023 |
| 45122 | 1023 |
| 45123 | 1023 |
| 45124 | 1023 |
| 45125 | 1023 |
| 45126 | 1023 |
| 45127 | 1023 |
| 45128 | 1023 |
| 45129 | 1023 |
| 45130 | 1023 |
| 45131 | 1023 |
| 45132 | 1023 |
| 45133 | 1023 |
| 45134 | 1023 |
| 45135 | 1023 |
| 45136 | 1023 |
| 45137 | 1023 |
| 45138 | 1023 |
| 45139 | 1023 |
| 45140 | 1023 |
| 45141 | 1023 |
| 45142 | 1023 |
| 45143 | 1023 |
| 45144 | 0 |
| 45145 | 0 |
| 45146 | 0 |
| 45147 | 0 |
| 45148 | 0 |
| 45149 | 0 |
| 45150 | 0 |
| 45151 | 0 |
| 45152 | 0 |
| 45153 | 0 |
| 45154 | 0 |
| 45155 | 0 |
| 45156 | 0 |
| 45157 | 1023 |
| 45158 | 1023 |
| 45159 | 1023 |
| 45160 | 1023 |
| 45161 | 1023 |
| 45162 | 1023 |
| 45163 | 1023 |
| 45164 | 1023 |
| 45165 | 1023 |
| 45166 | 1023 |
| 45167 | 1023 |
| 45168 | 1023 |
| 45169 | 1023 |
| 45170 | 1023 |
| 45171 | 1023 |
| 45172 | 1023 |
| 45173 | 1023 |
| 45174 | 1023 |
| 45175 | 1023 |
| 45176 | 1023 |
| 45177 | 1023 |
| 45178 | 1023 |
| 45179 | 1023 |
| 45180 | 1023 |
| 45181 | 1023 |
| 45182 | 1023 |
| 45183 | 1023 |
| 45184 | 1023 |
| 45185 | 1023 |
| 45186 | 1023 |
| 45187 | 1023 |
| 45188 | 1023 |
| 45189 | 1023 |
| 45190 | 1023 |
| 45191 | 1023 |
| 45192 | 1023 |
| 45193 | 1023 |
| 45194 | 1023 |
| 45195 | 0 |
| 45196 | 0 |
| 45197 | 0 |
| 45198 | 0 |
| 45199 | 0 |
| 45200 | 0 |
| 45201 | 0 |
| 45202 | 0 |
| 45203 | 0 |
| 45204 | 0 |
| 45205 | 0 |
| 45206 | 0 |
| 45207 | 0 |
| 45208 | 1023 |
| 45209 | 1023 |
| 45210 | 1023 |
| 45211 | 1023 |
| 45212 | 1023 |
| 45213 | 1023 |
| 45214 | 1023 |
| 45215 | 1023 |
| 45216 | 1023 |
| 45217 | 1023 |
| 45218 | 1023 |
| 45219 | 1023 |
| 45220 | 1023 |
| 45221 | 1023 |
| 45222 | 1023 |
| 45223 | 1023 |
| 45224 | 1023 |
| 45225 | 1023 |
| 45226 | 1023 |
| 45227 | 1023 |
| 45228 | 1023 |
| 45229 | 1023 |
| 45230 | 1023 |
| 45231 | 1023 |
| 45232 | 1023 |
| 45233 | 1023 |
| 45234 | 1023 |
| 45235 | 1023 |
| 45236 | 1023 |
| 45237 | 1023 |
| 45238 | 1023 |
| 45239 | 1023 |
| 45240 | 1023 |
| 45241 | 1023 |
| 45242 | 1023 |
| 45243 | 1023 |
| 45244 | 1023 |
| 45245 | 1023 |
| 45246 | 0 |
| 45247 | 0 |
| 45248 | 0 |
| 45249 | 0 |
| 45250 | 0 |
| 45251 | 0 |
| 45252 | 0 |
| 45253 | 0 |
| 45254 | 0 |
| 45255 | 0 |
| 45256 | 0 |
| 45257 | 0 |
| 45258 | 0 |